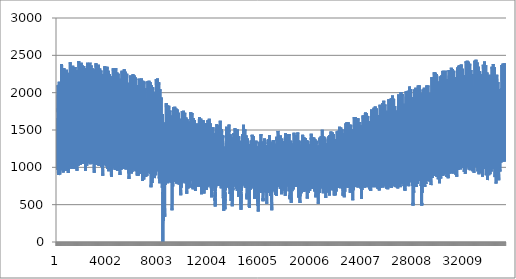
| Category | Series 0 |
|---|---|
| 0 | 1554 |
| 1 | 1593 |
| 2 | 1569 |
| 3 | 1538 |
| 4 | 1501 |
| 5 | 1464 |
| 6 | 1432 |
| 7 | 1389 |
| 8 | 1343 |
| 9 | 1313 |
| 10 | 1277 |
| 11 | 1236 |
| 12 | 1193 |
| 13 | 1161 |
| 14 | 1139 |
| 15 | 1112 |
| 16 | 1097 |
| 17 | 1086 |
| 18 | 1069 |
| 19 | 1056 |
| 20 | 1046 |
| 21 | 1014 |
| 22 | 1013 |
| 23 | 970 |
| 24 | 993 |
| 25 | 998 |
| 26 | 1007 |
| 27 | 1015 |
| 28 | 1045 |
| 29 | 1055 |
| 30 | 1077 |
| 31 | 1094 |
| 32 | 1115 |
| 33 | 1105 |
| 34 | 1113 |
| 35 | 1154 |
| 36 | 1174 |
| 37 | 1217 |
| 38 | 1255 |
| 39 | 1284 |
| 40 | 1311 |
| 41 | 1350 |
| 42 | 1391 |
| 43 | 1439 |
| 44 | 1500 |
| 45 | 1583 |
| 46 | 1633 |
| 47 | 1656 |
| 48 | 1660 |
| 49 | 1593 |
| 50 | 1501 |
| 51 | 1343 |
| 52 | 1271 |
| 53 | 1261 |
| 54 | 1353 |
| 55 | 1409 |
| 56 | 1440 |
| 57 | 1434 |
| 58 | 1399 |
| 59 | 1399 |
| 60 | 1402 |
| 61 | 1410 |
| 62 | 1486 |
| 63 | 1523 |
| 64 | 1577 |
| 65 | 1654 |
| 66 | 1715 |
| 67 | 1828 |
| 68 | 1957 |
| 69 | 2010 |
| 70 | 2057 |
| 71 | 2098 |
| 72 | 2079 |
| 73 | 2075 |
| 74 | 2071 |
| 75 | 2047 |
| 76 | 2048 |
| 77 | 2034 |
| 78 | 2006 |
| 79 | 1972 |
| 80 | 1940 |
| 81 | 1876 |
| 82 | 1794 |
| 83 | 1745 |
| 84 | 1750 |
| 85 | 1739 |
| 86 | 1791 |
| 87 | 1795 |
| 88 | 1729 |
| 89 | 1660 |
| 90 | 1592 |
| 91 | 1515 |
| 92 | 1434 |
| 93 | 1372 |
| 94 | 1283 |
| 95 | 1219 |
| 96 | 1206 |
| 97 | 1208 |
| 98 | 1155 |
| 99 | 1117 |
| 100 | 1081 |
| 101 | 1044 |
| 102 | 1017 |
| 103 | 992 |
| 104 | 969 |
| 105 | 948 |
| 106 | 933 |
| 107 | 922 |
| 108 | 910 |
| 109 | 896 |
| 110 | 894 |
| 111 | 899 |
| 112 | 913 |
| 113 | 915 |
| 114 | 923 |
| 115 | 933 |
| 116 | 946 |
| 117 | 945 |
| 118 | 961 |
| 119 | 946 |
| 120 | 1003 |
| 121 | 1028 |
| 122 | 1058 |
| 123 | 1098 |
| 124 | 1146 |
| 125 | 1201 |
| 126 | 1261 |
| 127 | 1313 |
| 128 | 1360 |
| 129 | 1370 |
| 130 | 1426 |
| 131 | 1469 |
| 132 | 1501 |
| 133 | 1541 |
| 134 | 1577 |
| 135 | 1601 |
| 136 | 1612 |
| 137 | 1650 |
| 138 | 1670 |
| 139 | 1691 |
| 140 | 1720 |
| 141 | 1763 |
| 142 | 1813 |
| 143 | 1829 |
| 144 | 1787 |
| 145 | 1737 |
| 146 | 1708 |
| 147 | 1689 |
| 148 | 1669 |
| 149 | 1605 |
| 150 | 1656 |
| 151 | 1648 |
| 152 | 1659 |
| 153 | 1651 |
| 154 | 1648 |
| 155 | 1652 |
| 156 | 1652 |
| 157 | 1633 |
| 158 | 1633 |
| 159 | 1655 |
| 160 | 1696 |
| 161 | 1750 |
| 162 | 1795 |
| 163 | 1907 |
| 164 | 2030 |
| 165 | 2088 |
| 166 | 2120 |
| 167 | 2147 |
| 168 | 2155 |
| 169 | 2140 |
| 170 | 2124 |
| 171 | 2106 |
| 172 | 2069 |
| 173 | 2034 |
| 174 | 1998 |
| 175 | 1949 |
| 176 | 1898 |
| 177 | 1846 |
| 178 | 1776 |
| 179 | 1715 |
| 180 | 1696 |
| 181 | 1675 |
| 182 | 1713 |
| 183 | 1715 |
| 184 | 1656 |
| 185 | 1610 |
| 186 | 1554 |
| 187 | 1494 |
| 188 | 1437 |
| 189 | 1380 |
| 190 | 1308 |
| 191 | 1246 |
| 192 | 1346 |
| 193 | 1355 |
| 194 | 1308 |
| 195 | 1266 |
| 196 | 1228 |
| 197 | 1186 |
| 198 | 1148 |
| 199 | 1113 |
| 200 | 1092 |
| 201 | 1074 |
| 202 | 1058 |
| 203 | 1043 |
| 204 | 1032 |
| 205 | 1015 |
| 206 | 1005 |
| 207 | 996 |
| 208 | 1002 |
| 209 | 987 |
| 210 | 982 |
| 211 | 981 |
| 212 | 975 |
| 213 | 958 |
| 214 | 946 |
| 215 | 905 |
| 216 | 941 |
| 217 | 945 |
| 218 | 957 |
| 219 | 981 |
| 220 | 1025 |
| 221 | 1063 |
| 222 | 1118 |
| 223 | 1172 |
| 224 | 1201 |
| 225 | 1231 |
| 226 | 1283 |
| 227 | 1343 |
| 228 | 1373 |
| 229 | 1395 |
| 230 | 1420 |
| 231 | 1470 |
| 232 | 1514 |
| 233 | 1546 |
| 234 | 1560 |
| 235 | 1544 |
| 236 | 1589 |
| 237 | 1656 |
| 238 | 1722 |
| 239 | 1737 |
| 240 | 1680 |
| 241 | 1578 |
| 242 | 1558 |
| 243 | 1493 |
| 244 | 1397 |
| 245 | 1388 |
| 246 | 1459 |
| 247 | 1465 |
| 248 | 1441 |
| 249 | 1452 |
| 250 | 1449 |
| 251 | 1425 |
| 252 | 1396 |
| 253 | 1398 |
| 254 | 1440 |
| 255 | 1494 |
| 256 | 1539 |
| 257 | 1600 |
| 258 | 1680 |
| 259 | 1798 |
| 260 | 1945 |
| 261 | 2019 |
| 262 | 2076 |
| 263 | 2113 |
| 264 | 2129 |
| 265 | 2132 |
| 266 | 2124 |
| 267 | 2116 |
| 268 | 2091 |
| 269 | 2043 |
| 270 | 2016 |
| 271 | 1970 |
| 272 | 1933 |
| 273 | 1874 |
| 274 | 1803 |
| 275 | 1745 |
| 276 | 1762 |
| 277 | 1732 |
| 278 | 1768 |
| 279 | 1777 |
| 280 | 1712 |
| 281 | 1641 |
| 282 | 1584 |
| 283 | 1503 |
| 284 | 1413 |
| 285 | 1346 |
| 286 | 1280 |
| 287 | 1215 |
| 288 | 1256 |
| 289 | 1265 |
| 290 | 1226 |
| 291 | 1192 |
| 292 | 1152 |
| 293 | 1112 |
| 294 | 1086 |
| 295 | 1059 |
| 296 | 1034 |
| 297 | 1016 |
| 298 | 998 |
| 299 | 990 |
| 300 | 977 |
| 301 | 969 |
| 302 | 972 |
| 303 | 974 |
| 304 | 1005 |
| 305 | 1010 |
| 306 | 1025 |
| 307 | 1052 |
| 308 | 1098 |
| 309 | 1119 |
| 310 | 1139 |
| 311 | 1173 |
| 312 | 1292 |
| 313 | 1355 |
| 314 | 1422 |
| 315 | 1490 |
| 316 | 1584 |
| 317 | 1666 |
| 318 | 1726 |
| 319 | 1804 |
| 320 | 1832 |
| 321 | 1828 |
| 322 | 1854 |
| 323 | 1856 |
| 324 | 1850 |
| 325 | 1861 |
| 326 | 1908 |
| 327 | 1931 |
| 328 | 1951 |
| 329 | 1952 |
| 330 | 1962 |
| 331 | 1976 |
| 332 | 2011 |
| 333 | 2050 |
| 334 | 2088 |
| 335 | 2088 |
| 336 | 2052 |
| 337 | 2046 |
| 338 | 2010 |
| 339 | 1995 |
| 340 | 1990 |
| 341 | 2002 |
| 342 | 2034 |
| 343 | 1995 |
| 344 | 1982 |
| 345 | 1993 |
| 346 | 1992 |
| 347 | 1976 |
| 348 | 1983 |
| 349 | 1993 |
| 350 | 1989 |
| 351 | 1986 |
| 352 | 2018 |
| 353 | 2061 |
| 354 | 2099 |
| 355 | 2200 |
| 356 | 2285 |
| 357 | 2332 |
| 358 | 2359 |
| 359 | 2385 |
| 360 | 2383 |
| 361 | 2364 |
| 362 | 2351 |
| 363 | 2336 |
| 364 | 2285 |
| 365 | 2240 |
| 366 | 2202 |
| 367 | 2162 |
| 368 | 2092 |
| 369 | 2018 |
| 370 | 1950 |
| 371 | 1899 |
| 372 | 1889 |
| 373 | 1852 |
| 374 | 1873 |
| 375 | 1865 |
| 376 | 1776 |
| 377 | 1692 |
| 378 | 1616 |
| 379 | 1521 |
| 380 | 1425 |
| 381 | 1349 |
| 382 | 1274 |
| 383 | 1214 |
| 384 | 1248 |
| 385 | 1248 |
| 386 | 1194 |
| 387 | 1159 |
| 388 | 1120 |
| 389 | 1090 |
| 390 | 1056 |
| 391 | 1038 |
| 392 | 1024 |
| 393 | 1015 |
| 394 | 1006 |
| 395 | 990 |
| 396 | 984 |
| 397 | 974 |
| 398 | 964 |
| 399 | 960 |
| 400 | 985 |
| 401 | 984 |
| 402 | 1007 |
| 403 | 1021 |
| 404 | 1058 |
| 405 | 1077 |
| 406 | 1109 |
| 407 | 1136 |
| 408 | 1253 |
| 409 | 1326 |
| 410 | 1394 |
| 411 | 1476 |
| 412 | 1564 |
| 413 | 1638 |
| 414 | 1696 |
| 415 | 1764 |
| 416 | 1785 |
| 417 | 1768 |
| 418 | 1757 |
| 419 | 1751 |
| 420 | 1734 |
| 421 | 1744 |
| 422 | 1738 |
| 423 | 1716 |
| 424 | 1721 |
| 425 | 1695 |
| 426 | 1602 |
| 427 | 1555 |
| 428 | 1536 |
| 429 | 1537 |
| 430 | 1544 |
| 431 | 1535 |
| 432 | 1526 |
| 433 | 1494 |
| 434 | 1467 |
| 435 | 1537 |
| 436 | 1605 |
| 437 | 1644 |
| 438 | 1681 |
| 439 | 1646 |
| 440 | 1690 |
| 441 | 1724 |
| 442 | 1733 |
| 443 | 1724 |
| 444 | 1726 |
| 445 | 1734 |
| 446 | 1763 |
| 447 | 1799 |
| 448 | 1822 |
| 449 | 1868 |
| 450 | 1918 |
| 451 | 1982 |
| 452 | 2129 |
| 453 | 2224 |
| 454 | 2278 |
| 455 | 2320 |
| 456 | 2319 |
| 457 | 2317 |
| 458 | 2297 |
| 459 | 2278 |
| 460 | 2235 |
| 461 | 2187 |
| 462 | 2143 |
| 463 | 2110 |
| 464 | 2041 |
| 465 | 1976 |
| 466 | 1910 |
| 467 | 1857 |
| 468 | 1844 |
| 469 | 1794 |
| 470 | 1812 |
| 471 | 1794 |
| 472 | 1692 |
| 473 | 1618 |
| 474 | 1566 |
| 475 | 1475 |
| 476 | 1368 |
| 477 | 1290 |
| 478 | 1220 |
| 479 | 1153 |
| 480 | 1177 |
| 481 | 1193 |
| 482 | 1159 |
| 483 | 1121 |
| 484 | 1084 |
| 485 | 1050 |
| 486 | 1015 |
| 487 | 991 |
| 488 | 973 |
| 489 | 949 |
| 490 | 938 |
| 491 | 930 |
| 492 | 927 |
| 493 | 929 |
| 494 | 938 |
| 495 | 935 |
| 496 | 965 |
| 497 | 963 |
| 498 | 981 |
| 499 | 1009 |
| 500 | 1048 |
| 501 | 1051 |
| 502 | 1084 |
| 503 | 1117 |
| 504 | 1232 |
| 505 | 1299 |
| 506 | 1356 |
| 507 | 1426 |
| 508 | 1523 |
| 509 | 1579 |
| 510 | 1634 |
| 511 | 1700 |
| 512 | 1737 |
| 513 | 1702 |
| 514 | 1707 |
| 515 | 1707 |
| 516 | 1677 |
| 517 | 1660 |
| 518 | 1654 |
| 519 | 1636 |
| 520 | 1588 |
| 521 | 1566 |
| 522 | 1496 |
| 523 | 1457 |
| 524 | 1459 |
| 525 | 1444 |
| 526 | 1465 |
| 527 | 1513 |
| 528 | 1585 |
| 529 | 1564 |
| 530 | 1508 |
| 531 | 1463 |
| 532 | 1508 |
| 533 | 1549 |
| 534 | 1607 |
| 535 | 1550 |
| 536 | 1544 |
| 537 | 1590 |
| 538 | 1617 |
| 539 | 1658 |
| 540 | 1696 |
| 541 | 1688 |
| 542 | 1743 |
| 543 | 1769 |
| 544 | 1798 |
| 545 | 1845 |
| 546 | 1894 |
| 547 | 1968 |
| 548 | 2124 |
| 549 | 2225 |
| 550 | 2288 |
| 551 | 2326 |
| 552 | 2317 |
| 553 | 2291 |
| 554 | 2276 |
| 555 | 2270 |
| 556 | 2231 |
| 557 | 2181 |
| 558 | 2156 |
| 559 | 2123 |
| 560 | 2064 |
| 561 | 1976 |
| 562 | 1898 |
| 563 | 1854 |
| 564 | 1855 |
| 565 | 1819 |
| 566 | 1836 |
| 567 | 1819 |
| 568 | 1737 |
| 569 | 1663 |
| 570 | 1590 |
| 571 | 1508 |
| 572 | 1412 |
| 573 | 1330 |
| 574 | 1259 |
| 575 | 1196 |
| 576 | 1237 |
| 577 | 1247 |
| 578 | 1204 |
| 579 | 1164 |
| 580 | 1133 |
| 581 | 1104 |
| 582 | 1070 |
| 583 | 1035 |
| 584 | 1013 |
| 585 | 998 |
| 586 | 987 |
| 587 | 980 |
| 588 | 975 |
| 589 | 964 |
| 590 | 965 |
| 591 | 964 |
| 592 | 992 |
| 593 | 990 |
| 594 | 1003 |
| 595 | 1027 |
| 596 | 1073 |
| 597 | 1078 |
| 598 | 1110 |
| 599 | 1146 |
| 600 | 1265 |
| 601 | 1328 |
| 602 | 1397 |
| 603 | 1469 |
| 604 | 1556 |
| 605 | 1635 |
| 606 | 1699 |
| 607 | 1744 |
| 608 | 1782 |
| 609 | 1760 |
| 610 | 1755 |
| 611 | 1765 |
| 612 | 1743 |
| 613 | 1725 |
| 614 | 1725 |
| 615 | 1735 |
| 616 | 1771 |
| 617 | 1768 |
| 618 | 1761 |
| 619 | 1744 |
| 620 | 1762 |
| 621 | 1792 |
| 622 | 1795 |
| 623 | 1797 |
| 624 | 1790 |
| 625 | 1700 |
| 626 | 1732 |
| 627 | 1783 |
| 628 | 1799 |
| 629 | 1837 |
| 630 | 1870 |
| 631 | 1849 |
| 632 | 1840 |
| 633 | 1780 |
| 634 | 1793 |
| 635 | 1829 |
| 636 | 1825 |
| 637 | 1805 |
| 638 | 1812 |
| 639 | 1821 |
| 640 | 1857 |
| 641 | 1919 |
| 642 | 1985 |
| 643 | 2046 |
| 644 | 2118 |
| 645 | 2170 |
| 646 | 2220 |
| 647 | 2257 |
| 648 | 2259 |
| 649 | 2241 |
| 650 | 2237 |
| 651 | 2221 |
| 652 | 2169 |
| 653 | 2116 |
| 654 | 2080 |
| 655 | 2054 |
| 656 | 1993 |
| 657 | 1919 |
| 658 | 1858 |
| 659 | 1799 |
| 660 | 1786 |
| 661 | 1746 |
| 662 | 1771 |
| 663 | 1764 |
| 664 | 1659 |
| 665 | 1581 |
| 666 | 1507 |
| 667 | 1426 |
| 668 | 1350 |
| 669 | 1285 |
| 670 | 1221 |
| 671 | 1163 |
| 672 | 1233 |
| 673 | 1252 |
| 674 | 1200 |
| 675 | 1155 |
| 676 | 1113 |
| 677 | 1078 |
| 678 | 1045 |
| 679 | 1013 |
| 680 | 999 |
| 681 | 984 |
| 682 | 973 |
| 683 | 968 |
| 684 | 960 |
| 685 | 954 |
| 686 | 957 |
| 687 | 963 |
| 688 | 981 |
| 689 | 981 |
| 690 | 995 |
| 691 | 1015 |
| 692 | 1060 |
| 693 | 1072 |
| 694 | 1098 |
| 695 | 1115 |
| 696 | 1216 |
| 697 | 1277 |
| 698 | 1343 |
| 699 | 1412 |
| 700 | 1495 |
| 701 | 1568 |
| 702 | 1642 |
| 703 | 1713 |
| 704 | 1731 |
| 705 | 1745 |
| 706 | 1768 |
| 707 | 1759 |
| 708 | 1733 |
| 709 | 1697 |
| 710 | 1715 |
| 711 | 1737 |
| 712 | 1750 |
| 713 | 1686 |
| 714 | 1659 |
| 715 | 1697 |
| 716 | 1742 |
| 717 | 1781 |
| 718 | 1788 |
| 719 | 1783 |
| 720 | 1745 |
| 721 | 1660 |
| 722 | 1639 |
| 723 | 1588 |
| 724 | 1548 |
| 725 | 1577 |
| 726 | 1635 |
| 727 | 1637 |
| 728 | 1639 |
| 729 | 1660 |
| 730 | 1664 |
| 731 | 1650 |
| 732 | 1652 |
| 733 | 1661 |
| 734 | 1689 |
| 735 | 1717 |
| 736 | 1775 |
| 737 | 1830 |
| 738 | 1880 |
| 739 | 1975 |
| 740 | 2102 |
| 741 | 2204 |
| 742 | 2272 |
| 743 | 2306 |
| 744 | 2291 |
| 745 | 2284 |
| 746 | 2271 |
| 747 | 2244 |
| 748 | 2197 |
| 749 | 2152 |
| 750 | 2116 |
| 751 | 2074 |
| 752 | 2018 |
| 753 | 1947 |
| 754 | 1894 |
| 755 | 1837 |
| 756 | 1833 |
| 757 | 1801 |
| 758 | 1831 |
| 759 | 1823 |
| 760 | 1756 |
| 761 | 1703 |
| 762 | 1643 |
| 763 | 1585 |
| 764 | 1506 |
| 765 | 1436 |
| 766 | 1364 |
| 767 | 1294 |
| 768 | 1326 |
| 769 | 1330 |
| 770 | 1277 |
| 771 | 1241 |
| 772 | 1203 |
| 773 | 1164 |
| 774 | 1134 |
| 775 | 1106 |
| 776 | 1082 |
| 777 | 1059 |
| 778 | 1041 |
| 779 | 1028 |
| 780 | 1017 |
| 781 | 1000 |
| 782 | 998 |
| 783 | 1001 |
| 784 | 1012 |
| 785 | 1011 |
| 786 | 1014 |
| 787 | 1018 |
| 788 | 1028 |
| 789 | 1022 |
| 790 | 1037 |
| 791 | 1017 |
| 792 | 1078 |
| 793 | 1108 |
| 794 | 1142 |
| 795 | 1183 |
| 796 | 1240 |
| 797 | 1299 |
| 798 | 1366 |
| 799 | 1430 |
| 800 | 1477 |
| 801 | 1505 |
| 802 | 1560 |
| 803 | 1599 |
| 804 | 1629 |
| 805 | 1646 |
| 806 | 1683 |
| 807 | 1706 |
| 808 | 1713 |
| 809 | 1709 |
| 810 | 1708 |
| 811 | 1721 |
| 812 | 1780 |
| 813 | 1829 |
| 814 | 1850 |
| 815 | 1849 |
| 816 | 1820 |
| 817 | 1767 |
| 818 | 1759 |
| 819 | 1725 |
| 820 | 1688 |
| 821 | 1649 |
| 822 | 1703 |
| 823 | 1703 |
| 824 | 1718 |
| 825 | 1721 |
| 826 | 1709 |
| 827 | 1723 |
| 828 | 1733 |
| 829 | 1714 |
| 830 | 1711 |
| 831 | 1734 |
| 832 | 1756 |
| 833 | 1815 |
| 834 | 1868 |
| 835 | 1969 |
| 836 | 2091 |
| 837 | 2184 |
| 838 | 2235 |
| 839 | 2265 |
| 840 | 2273 |
| 841 | 2260 |
| 842 | 2245 |
| 843 | 2223 |
| 844 | 2188 |
| 845 | 2147 |
| 846 | 2102 |
| 847 | 2047 |
| 848 | 1991 |
| 849 | 1930 |
| 850 | 1853 |
| 851 | 1787 |
| 852 | 1780 |
| 853 | 1763 |
| 854 | 1799 |
| 855 | 1803 |
| 856 | 1740 |
| 857 | 1688 |
| 858 | 1623 |
| 859 | 1566 |
| 860 | 1502 |
| 861 | 1444 |
| 862 | 1371 |
| 863 | 1313 |
| 864 | 1343 |
| 865 | 1352 |
| 866 | 1301 |
| 867 | 1256 |
| 868 | 1220 |
| 869 | 1182 |
| 870 | 1144 |
| 871 | 1111 |
| 872 | 1090 |
| 873 | 1070 |
| 874 | 1050 |
| 875 | 1037 |
| 876 | 1022 |
| 877 | 1003 |
| 878 | 996 |
| 879 | 992 |
| 880 | 999 |
| 881 | 988 |
| 882 | 986 |
| 883 | 989 |
| 884 | 986 |
| 885 | 968 |
| 886 | 960 |
| 887 | 925 |
| 888 | 958 |
| 889 | 966 |
| 890 | 982 |
| 891 | 1005 |
| 892 | 1049 |
| 893 | 1085 |
| 894 | 1139 |
| 895 | 1195 |
| 896 | 1226 |
| 897 | 1263 |
| 898 | 1316 |
| 899 | 1367 |
| 900 | 1394 |
| 901 | 1408 |
| 902 | 1419 |
| 903 | 1443 |
| 904 | 1468 |
| 905 | 1497 |
| 906 | 1507 |
| 907 | 1506 |
| 908 | 1552 |
| 909 | 1635 |
| 910 | 1705 |
| 911 | 1726 |
| 912 | 1676 |
| 913 | 1597 |
| 914 | 1565 |
| 915 | 1477 |
| 916 | 1376 |
| 917 | 1348 |
| 918 | 1369 |
| 919 | 1350 |
| 920 | 1343 |
| 921 | 1362 |
| 922 | 1344 |
| 923 | 1336 |
| 924 | 1331 |
| 925 | 1357 |
| 926 | 1425 |
| 927 | 1477 |
| 928 | 1532 |
| 929 | 1594 |
| 930 | 1666 |
| 931 | 1767 |
| 932 | 1903 |
| 933 | 2016 |
| 934 | 2099 |
| 935 | 2139 |
| 936 | 2156 |
| 937 | 2159 |
| 938 | 2144 |
| 939 | 2127 |
| 940 | 2100 |
| 941 | 2052 |
| 942 | 2026 |
| 943 | 1981 |
| 944 | 1940 |
| 945 | 1881 |
| 946 | 1813 |
| 947 | 1752 |
| 948 | 1764 |
| 949 | 1737 |
| 950 | 1765 |
| 951 | 1771 |
| 952 | 1700 |
| 953 | 1628 |
| 954 | 1568 |
| 955 | 1493 |
| 956 | 1403 |
| 957 | 1335 |
| 958 | 1266 |
| 959 | 1201 |
| 960 | 1243 |
| 961 | 1255 |
| 962 | 1217 |
| 963 | 1183 |
| 964 | 1148 |
| 965 | 1112 |
| 966 | 1082 |
| 967 | 1056 |
| 968 | 1034 |
| 969 | 1017 |
| 970 | 1000 |
| 971 | 992 |
| 972 | 983 |
| 973 | 977 |
| 974 | 985 |
| 975 | 987 |
| 976 | 1018 |
| 977 | 1026 |
| 978 | 1043 |
| 979 | 1068 |
| 980 | 1114 |
| 981 | 1133 |
| 982 | 1167 |
| 983 | 1211 |
| 984 | 1336 |
| 985 | 1414 |
| 986 | 1489 |
| 987 | 1559 |
| 988 | 1657 |
| 989 | 1729 |
| 990 | 1789 |
| 991 | 1857 |
| 992 | 1885 |
| 993 | 1881 |
| 994 | 1908 |
| 995 | 1910 |
| 996 | 1904 |
| 997 | 1912 |
| 998 | 1942 |
| 999 | 1961 |
| 1000 | 1982 |
| 1001 | 1983 |
| 1002 | 1993 |
| 1003 | 2004 |
| 1004 | 2032 |
| 1005 | 2063 |
| 1006 | 2103 |
| 1007 | 2109 |
| 1008 | 2085 |
| 1009 | 2074 |
| 1010 | 2038 |
| 1011 | 2025 |
| 1012 | 2027 |
| 1013 | 2036 |
| 1014 | 2075 |
| 1015 | 2044 |
| 1016 | 2029 |
| 1017 | 2018 |
| 1018 | 2008 |
| 1019 | 1999 |
| 1020 | 2004 |
| 1021 | 2013 |
| 1022 | 2009 |
| 1023 | 2010 |
| 1024 | 2036 |
| 1025 | 2067 |
| 1026 | 2097 |
| 1027 | 2180 |
| 1028 | 2276 |
| 1029 | 2329 |
| 1030 | 2371 |
| 1031 | 2407 |
| 1032 | 2399 |
| 1033 | 2386 |
| 1034 | 2369 |
| 1035 | 2358 |
| 1036 | 2305 |
| 1037 | 2265 |
| 1038 | 2226 |
| 1039 | 2177 |
| 1040 | 2113 |
| 1041 | 2037 |
| 1042 | 1968 |
| 1043 | 1914 |
| 1044 | 1903 |
| 1045 | 1866 |
| 1046 | 1891 |
| 1047 | 1875 |
| 1048 | 1781 |
| 1049 | 1701 |
| 1050 | 1622 |
| 1051 | 1534 |
| 1052 | 1441 |
| 1053 | 1369 |
| 1054 | 1296 |
| 1055 | 1235 |
| 1056 | 1276 |
| 1057 | 1282 |
| 1058 | 1235 |
| 1059 | 1199 |
| 1060 | 1164 |
| 1061 | 1131 |
| 1062 | 1098 |
| 1063 | 1081 |
| 1064 | 1065 |
| 1065 | 1052 |
| 1066 | 1042 |
| 1067 | 1027 |
| 1068 | 1021 |
| 1069 | 1013 |
| 1070 | 1010 |
| 1071 | 1010 |
| 1072 | 1034 |
| 1073 | 1034 |
| 1074 | 1057 |
| 1075 | 1074 |
| 1076 | 1110 |
| 1077 | 1131 |
| 1078 | 1164 |
| 1079 | 1195 |
| 1080 | 1322 |
| 1081 | 1408 |
| 1082 | 1487 |
| 1083 | 1569 |
| 1084 | 1657 |
| 1085 | 1726 |
| 1086 | 1781 |
| 1087 | 1841 |
| 1088 | 1875 |
| 1089 | 1857 |
| 1090 | 1856 |
| 1091 | 1852 |
| 1092 | 1830 |
| 1093 | 1833 |
| 1094 | 1832 |
| 1095 | 1823 |
| 1096 | 1830 |
| 1097 | 1818 |
| 1098 | 1772 |
| 1099 | 1748 |
| 1100 | 1746 |
| 1101 | 1755 |
| 1102 | 1779 |
| 1103 | 1780 |
| 1104 | 1764 |
| 1105 | 1736 |
| 1106 | 1707 |
| 1107 | 1729 |
| 1108 | 1752 |
| 1109 | 1779 |
| 1110 | 1814 |
| 1111 | 1790 |
| 1112 | 1813 |
| 1113 | 1831 |
| 1114 | 1830 |
| 1115 | 1819 |
| 1116 | 1820 |
| 1117 | 1822 |
| 1118 | 1841 |
| 1119 | 1868 |
| 1120 | 1890 |
| 1121 | 1933 |
| 1122 | 1971 |
| 1123 | 2032 |
| 1124 | 2163 |
| 1125 | 2260 |
| 1126 | 2318 |
| 1127 | 2356 |
| 1128 | 2356 |
| 1129 | 2349 |
| 1130 | 2334 |
| 1131 | 2322 |
| 1132 | 2281 |
| 1133 | 2233 |
| 1134 | 2190 |
| 1135 | 2152 |
| 1136 | 2086 |
| 1137 | 2019 |
| 1138 | 1950 |
| 1139 | 1896 |
| 1140 | 1877 |
| 1141 | 1836 |
| 1142 | 1856 |
| 1143 | 1836 |
| 1144 | 1736 |
| 1145 | 1660 |
| 1146 | 1596 |
| 1147 | 1515 |
| 1148 | 1414 |
| 1149 | 1343 |
| 1150 | 1270 |
| 1151 | 1205 |
| 1152 | 1237 |
| 1153 | 1251 |
| 1154 | 1213 |
| 1155 | 1176 |
| 1156 | 1138 |
| 1157 | 1105 |
| 1158 | 1071 |
| 1159 | 1046 |
| 1160 | 1028 |
| 1161 | 1008 |
| 1162 | 994 |
| 1163 | 985 |
| 1164 | 982 |
| 1165 | 980 |
| 1166 | 983 |
| 1167 | 985 |
| 1168 | 1011 |
| 1169 | 1014 |
| 1170 | 1032 |
| 1171 | 1062 |
| 1172 | 1099 |
| 1173 | 1105 |
| 1174 | 1143 |
| 1175 | 1179 |
| 1176 | 1305 |
| 1177 | 1384 |
| 1178 | 1451 |
| 1179 | 1527 |
| 1180 | 1625 |
| 1181 | 1682 |
| 1182 | 1743 |
| 1183 | 1807 |
| 1184 | 1830 |
| 1185 | 1808 |
| 1186 | 1814 |
| 1187 | 1813 |
| 1188 | 1788 |
| 1189 | 1772 |
| 1190 | 1766 |
| 1191 | 1753 |
| 1192 | 1717 |
| 1193 | 1703 |
| 1194 | 1660 |
| 1195 | 1659 |
| 1196 | 1668 |
| 1197 | 1662 |
| 1198 | 1675 |
| 1199 | 1713 |
| 1200 | 1758 |
| 1201 | 1741 |
| 1202 | 1709 |
| 1203 | 1671 |
| 1204 | 1678 |
| 1205 | 1703 |
| 1206 | 1757 |
| 1207 | 1720 |
| 1208 | 1718 |
| 1209 | 1745 |
| 1210 | 1756 |
| 1211 | 1786 |
| 1212 | 1813 |
| 1213 | 1808 |
| 1214 | 1847 |
| 1215 | 1858 |
| 1216 | 1883 |
| 1217 | 1921 |
| 1218 | 1960 |
| 1219 | 2019 |
| 1220 | 2156 |
| 1221 | 2255 |
| 1222 | 2321 |
| 1223 | 2359 |
| 1224 | 2351 |
| 1225 | 2336 |
| 1226 | 2320 |
| 1227 | 2314 |
| 1228 | 2272 |
| 1229 | 2223 |
| 1230 | 2191 |
| 1231 | 2157 |
| 1232 | 2097 |
| 1233 | 2010 |
| 1234 | 1935 |
| 1235 | 1886 |
| 1236 | 1885 |
| 1237 | 1843 |
| 1238 | 1867 |
| 1239 | 1849 |
| 1240 | 1764 |
| 1241 | 1686 |
| 1242 | 1610 |
| 1243 | 1527 |
| 1244 | 1433 |
| 1245 | 1353 |
| 1246 | 1281 |
| 1247 | 1219 |
| 1248 | 1258 |
| 1249 | 1273 |
| 1250 | 1231 |
| 1251 | 1194 |
| 1252 | 1163 |
| 1253 | 1129 |
| 1254 | 1096 |
| 1255 | 1064 |
| 1256 | 1042 |
| 1257 | 1029 |
| 1258 | 1016 |
| 1259 | 1008 |
| 1260 | 1002 |
| 1261 | 994 |
| 1262 | 995 |
| 1263 | 997 |
| 1264 | 1024 |
| 1265 | 1025 |
| 1266 | 1044 |
| 1267 | 1069 |
| 1268 | 1114 |
| 1269 | 1121 |
| 1270 | 1156 |
| 1271 | 1192 |
| 1272 | 1323 |
| 1273 | 1401 |
| 1274 | 1472 |
| 1275 | 1548 |
| 1276 | 1639 |
| 1277 | 1715 |
| 1278 | 1776 |
| 1279 | 1822 |
| 1280 | 1856 |
| 1281 | 1834 |
| 1282 | 1835 |
| 1283 | 1844 |
| 1284 | 1835 |
| 1285 | 1829 |
| 1286 | 1835 |
| 1287 | 1841 |
| 1288 | 1873 |
| 1289 | 1872 |
| 1290 | 1871 |
| 1291 | 1866 |
| 1292 | 1883 |
| 1293 | 1919 |
| 1294 | 1939 |
| 1295 | 1950 |
| 1296 | 1934 |
| 1297 | 1869 |
| 1298 | 1866 |
| 1299 | 1877 |
| 1300 | 1871 |
| 1301 | 1882 |
| 1302 | 1898 |
| 1303 | 1878 |
| 1304 | 1878 |
| 1305 | 1842 |
| 1306 | 1855 |
| 1307 | 1878 |
| 1308 | 1881 |
| 1309 | 1878 |
| 1310 | 1881 |
| 1311 | 1882 |
| 1312 | 1910 |
| 1313 | 1958 |
| 1314 | 2002 |
| 1315 | 2066 |
| 1316 | 2164 |
| 1317 | 2233 |
| 1318 | 2279 |
| 1319 | 2317 |
| 1320 | 2319 |
| 1321 | 2313 |
| 1322 | 2309 |
| 1323 | 2290 |
| 1324 | 2238 |
| 1325 | 2183 |
| 1326 | 2150 |
| 1327 | 2121 |
| 1328 | 2058 |
| 1329 | 1984 |
| 1330 | 1915 |
| 1331 | 1858 |
| 1332 | 1846 |
| 1333 | 1807 |
| 1334 | 1830 |
| 1335 | 1823 |
| 1336 | 1721 |
| 1337 | 1641 |
| 1338 | 1565 |
| 1339 | 1487 |
| 1340 | 1408 |
| 1341 | 1342 |
| 1342 | 1269 |
| 1343 | 1208 |
| 1344 | 1248 |
| 1345 | 1269 |
| 1346 | 1219 |
| 1347 | 1177 |
| 1348 | 1139 |
| 1349 | 1106 |
| 1350 | 1075 |
| 1351 | 1046 |
| 1352 | 1029 |
| 1353 | 1015 |
| 1354 | 1000 |
| 1355 | 996 |
| 1356 | 989 |
| 1357 | 981 |
| 1358 | 987 |
| 1359 | 995 |
| 1360 | 1016 |
| 1361 | 1019 |
| 1362 | 1037 |
| 1363 | 1060 |
| 1364 | 1105 |
| 1365 | 1124 |
| 1366 | 1158 |
| 1367 | 1186 |
| 1368 | 1303 |
| 1369 | 1379 |
| 1370 | 1457 |
| 1371 | 1535 |
| 1372 | 1627 |
| 1373 | 1697 |
| 1374 | 1770 |
| 1375 | 1841 |
| 1376 | 1860 |
| 1377 | 1866 |
| 1378 | 1876 |
| 1379 | 1865 |
| 1380 | 1832 |
| 1381 | 1820 |
| 1382 | 1842 |
| 1383 | 1853 |
| 1384 | 1856 |
| 1385 | 1783 |
| 1386 | 1741 |
| 1387 | 1760 |
| 1388 | 1789 |
| 1389 | 1828 |
| 1390 | 1847 |
| 1391 | 1838 |
| 1392 | 1795 |
| 1393 | 1711 |
| 1394 | 1680 |
| 1395 | 1625 |
| 1396 | 1583 |
| 1397 | 1607 |
| 1398 | 1660 |
| 1399 | 1670 |
| 1400 | 1685 |
| 1401 | 1711 |
| 1402 | 1721 |
| 1403 | 1716 |
| 1404 | 1732 |
| 1405 | 1745 |
| 1406 | 1765 |
| 1407 | 1793 |
| 1408 | 1843 |
| 1409 | 1884 |
| 1410 | 1926 |
| 1411 | 1993 |
| 1412 | 2112 |
| 1413 | 2225 |
| 1414 | 2299 |
| 1415 | 2342 |
| 1416 | 2339 |
| 1417 | 2337 |
| 1418 | 2323 |
| 1419 | 2299 |
| 1420 | 2250 |
| 1421 | 2196 |
| 1422 | 2161 |
| 1423 | 2126 |
| 1424 | 2063 |
| 1425 | 1991 |
| 1426 | 1934 |
| 1427 | 1881 |
| 1428 | 1877 |
| 1429 | 1862 |
| 1430 | 1889 |
| 1431 | 1878 |
| 1432 | 1811 |
| 1433 | 1761 |
| 1434 | 1701 |
| 1435 | 1644 |
| 1436 | 1568 |
| 1437 | 1503 |
| 1438 | 1434 |
| 1439 | 1370 |
| 1440 | 1411 |
| 1441 | 1420 |
| 1442 | 1369 |
| 1443 | 1331 |
| 1444 | 1288 |
| 1445 | 1249 |
| 1446 | 1217 |
| 1447 | 1187 |
| 1448 | 1166 |
| 1449 | 1143 |
| 1450 | 1121 |
| 1451 | 1105 |
| 1452 | 1094 |
| 1453 | 1077 |
| 1454 | 1075 |
| 1455 | 1072 |
| 1456 | 1081 |
| 1457 | 1073 |
| 1458 | 1071 |
| 1459 | 1070 |
| 1460 | 1076 |
| 1461 | 1064 |
| 1462 | 1076 |
| 1463 | 1052 |
| 1464 | 1116 |
| 1465 | 1152 |
| 1466 | 1190 |
| 1467 | 1231 |
| 1468 | 1295 |
| 1469 | 1356 |
| 1470 | 1423 |
| 1471 | 1493 |
| 1472 | 1540 |
| 1473 | 1587 |
| 1474 | 1639 |
| 1475 | 1684 |
| 1476 | 1716 |
| 1477 | 1722 |
| 1478 | 1761 |
| 1479 | 1784 |
| 1480 | 1797 |
| 1481 | 1792 |
| 1482 | 1787 |
| 1483 | 1804 |
| 1484 | 1859 |
| 1485 | 1896 |
| 1486 | 1915 |
| 1487 | 1902 |
| 1488 | 1875 |
| 1489 | 1836 |
| 1490 | 1836 |
| 1491 | 1805 |
| 1492 | 1759 |
| 1493 | 1722 |
| 1494 | 1775 |
| 1495 | 1797 |
| 1496 | 1808 |
| 1497 | 1798 |
| 1498 | 1783 |
| 1499 | 1786 |
| 1500 | 1784 |
| 1501 | 1758 |
| 1502 | 1751 |
| 1503 | 1774 |
| 1504 | 1783 |
| 1505 | 1825 |
| 1506 | 1871 |
| 1507 | 1954 |
| 1508 | 2071 |
| 1509 | 2187 |
| 1510 | 2269 |
| 1511 | 2305 |
| 1512 | 2309 |
| 1513 | 2297 |
| 1514 | 2279 |
| 1515 | 2251 |
| 1516 | 2222 |
| 1517 | 2175 |
| 1518 | 2124 |
| 1519 | 2063 |
| 1520 | 2008 |
| 1521 | 1946 |
| 1522 | 1870 |
| 1523 | 1799 |
| 1524 | 1796 |
| 1525 | 1777 |
| 1526 | 1820 |
| 1527 | 1825 |
| 1528 | 1765 |
| 1529 | 1705 |
| 1530 | 1643 |
| 1531 | 1594 |
| 1532 | 1519 |
| 1533 | 1462 |
| 1534 | 1392 |
| 1535 | 1342 |
| 1536 | 1384 |
| 1537 | 1390 |
| 1538 | 1333 |
| 1539 | 1283 |
| 1540 | 1246 |
| 1541 | 1204 |
| 1542 | 1165 |
| 1543 | 1131 |
| 1544 | 1111 |
| 1545 | 1087 |
| 1546 | 1064 |
| 1547 | 1051 |
| 1548 | 1034 |
| 1549 | 1017 |
| 1550 | 1012 |
| 1551 | 1008 |
| 1552 | 1015 |
| 1553 | 1008 |
| 1554 | 1006 |
| 1555 | 1010 |
| 1556 | 1010 |
| 1557 | 994 |
| 1558 | 990 |
| 1559 | 954 |
| 1560 | 985 |
| 1561 | 994 |
| 1562 | 1019 |
| 1563 | 1039 |
| 1564 | 1082 |
| 1565 | 1120 |
| 1566 | 1171 |
| 1567 | 1229 |
| 1568 | 1257 |
| 1569 | 1307 |
| 1570 | 1367 |
| 1571 | 1422 |
| 1572 | 1458 |
| 1573 | 1487 |
| 1574 | 1505 |
| 1575 | 1525 |
| 1576 | 1548 |
| 1577 | 1580 |
| 1578 | 1588 |
| 1579 | 1611 |
| 1580 | 1654 |
| 1581 | 1737 |
| 1582 | 1799 |
| 1583 | 1813 |
| 1584 | 1757 |
| 1585 | 1703 |
| 1586 | 1655 |
| 1587 | 1558 |
| 1588 | 1483 |
| 1589 | 1471 |
| 1590 | 1450 |
| 1591 | 1377 |
| 1592 | 1357 |
| 1593 | 1369 |
| 1594 | 1374 |
| 1595 | 1399 |
| 1596 | 1406 |
| 1597 | 1435 |
| 1598 | 1501 |
| 1599 | 1526 |
| 1600 | 1569 |
| 1601 | 1624 |
| 1602 | 1681 |
| 1603 | 1759 |
| 1604 | 1872 |
| 1605 | 2014 |
| 1606 | 2124 |
| 1607 | 2171 |
| 1608 | 2192 |
| 1609 | 2191 |
| 1610 | 2172 |
| 1611 | 2150 |
| 1612 | 2116 |
| 1613 | 2070 |
| 1614 | 2040 |
| 1615 | 1997 |
| 1616 | 1956 |
| 1617 | 1892 |
| 1618 | 1827 |
| 1619 | 1767 |
| 1620 | 1772 |
| 1621 | 1747 |
| 1622 | 1776 |
| 1623 | 1780 |
| 1624 | 1703 |
| 1625 | 1633 |
| 1626 | 1564 |
| 1627 | 1495 |
| 1628 | 1403 |
| 1629 | 1336 |
| 1630 | 1266 |
| 1631 | 1209 |
| 1632 | 1254 |
| 1633 | 1268 |
| 1634 | 1234 |
| 1635 | 1197 |
| 1636 | 1167 |
| 1637 | 1134 |
| 1638 | 1100 |
| 1639 | 1074 |
| 1640 | 1056 |
| 1641 | 1041 |
| 1642 | 1028 |
| 1643 | 1018 |
| 1644 | 1015 |
| 1645 | 1007 |
| 1646 | 1013 |
| 1647 | 1018 |
| 1648 | 1048 |
| 1649 | 1059 |
| 1650 | 1070 |
| 1651 | 1090 |
| 1652 | 1132 |
| 1653 | 1147 |
| 1654 | 1189 |
| 1655 | 1241 |
| 1656 | 1379 |
| 1657 | 1473 |
| 1658 | 1557 |
| 1659 | 1625 |
| 1660 | 1728 |
| 1661 | 1791 |
| 1662 | 1849 |
| 1663 | 1899 |
| 1664 | 1929 |
| 1665 | 1920 |
| 1666 | 1938 |
| 1667 | 1943 |
| 1668 | 1932 |
| 1669 | 1924 |
| 1670 | 1936 |
| 1671 | 1919 |
| 1672 | 1909 |
| 1673 | 1899 |
| 1674 | 1939 |
| 1675 | 1971 |
| 1676 | 1987 |
| 1677 | 1998 |
| 1678 | 2034 |
| 1679 | 2034 |
| 1680 | 2026 |
| 1681 | 2018 |
| 1682 | 1998 |
| 1683 | 1993 |
| 1684 | 1964 |
| 1685 | 1948 |
| 1686 | 1993 |
| 1687 | 1978 |
| 1688 | 1968 |
| 1689 | 1919 |
| 1690 | 1889 |
| 1691 | 1925 |
| 1692 | 1965 |
| 1693 | 1966 |
| 1694 | 1946 |
| 1695 | 1944 |
| 1696 | 1981 |
| 1697 | 2021 |
| 1698 | 2054 |
| 1699 | 2121 |
| 1700 | 2216 |
| 1701 | 2308 |
| 1702 | 2378 |
| 1703 | 2425 |
| 1704 | 2419 |
| 1705 | 2414 |
| 1706 | 2397 |
| 1707 | 2386 |
| 1708 | 2332 |
| 1709 | 2297 |
| 1710 | 2255 |
| 1711 | 2207 |
| 1712 | 2154 |
| 1713 | 2075 |
| 1714 | 2000 |
| 1715 | 1938 |
| 1716 | 1919 |
| 1717 | 1880 |
| 1718 | 1908 |
| 1719 | 1889 |
| 1720 | 1795 |
| 1721 | 1718 |
| 1722 | 1634 |
| 1723 | 1549 |
| 1724 | 1464 |
| 1725 | 1393 |
| 1726 | 1325 |
| 1727 | 1265 |
| 1728 | 1309 |
| 1729 | 1321 |
| 1730 | 1279 |
| 1731 | 1244 |
| 1732 | 1215 |
| 1733 | 1182 |
| 1734 | 1153 |
| 1735 | 1132 |
| 1736 | 1113 |
| 1737 | 1095 |
| 1738 | 1087 |
| 1739 | 1074 |
| 1740 | 1063 |
| 1741 | 1056 |
| 1742 | 1061 |
| 1743 | 1063 |
| 1744 | 1088 |
| 1745 | 1088 |
| 1746 | 1111 |
| 1747 | 1136 |
| 1748 | 1171 |
| 1749 | 1192 |
| 1750 | 1228 |
| 1751 | 1262 |
| 1752 | 1400 |
| 1753 | 1499 |
| 1754 | 1587 |
| 1755 | 1667 |
| 1756 | 1755 |
| 1757 | 1816 |
| 1758 | 1867 |
| 1759 | 1908 |
| 1760 | 1944 |
| 1761 | 1937 |
| 1762 | 1938 |
| 1763 | 1928 |
| 1764 | 1886 |
| 1765 | 1866 |
| 1766 | 1853 |
| 1767 | 1839 |
| 1768 | 1822 |
| 1769 | 1810 |
| 1770 | 1835 |
| 1771 | 1841 |
| 1772 | 1852 |
| 1773 | 1883 |
| 1774 | 1906 |
| 1775 | 1890 |
| 1776 | 1868 |
| 1777 | 1856 |
| 1778 | 1802 |
| 1779 | 1772 |
| 1780 | 1733 |
| 1781 | 1736 |
| 1782 | 1772 |
| 1783 | 1767 |
| 1784 | 1768 |
| 1785 | 1763 |
| 1786 | 1756 |
| 1787 | 1757 |
| 1788 | 1770 |
| 1789 | 1771 |
| 1790 | 1792 |
| 1791 | 1820 |
| 1792 | 1854 |
| 1793 | 1895 |
| 1794 | 1938 |
| 1795 | 2004 |
| 1796 | 2121 |
| 1797 | 2231 |
| 1798 | 2332 |
| 1799 | 2384 |
| 1800 | 2387 |
| 1801 | 2381 |
| 1802 | 2377 |
| 1803 | 2368 |
| 1804 | 2326 |
| 1805 | 2284 |
| 1806 | 2242 |
| 1807 | 2198 |
| 1808 | 2134 |
| 1809 | 2064 |
| 1810 | 1996 |
| 1811 | 1938 |
| 1812 | 1915 |
| 1813 | 1884 |
| 1814 | 1908 |
| 1815 | 1882 |
| 1816 | 1784 |
| 1817 | 1704 |
| 1818 | 1626 |
| 1819 | 1549 |
| 1820 | 1458 |
| 1821 | 1393 |
| 1822 | 1321 |
| 1823 | 1259 |
| 1824 | 1300 |
| 1825 | 1306 |
| 1826 | 1267 |
| 1827 | 1230 |
| 1828 | 1195 |
| 1829 | 1163 |
| 1830 | 1135 |
| 1831 | 1107 |
| 1832 | 1088 |
| 1833 | 1074 |
| 1834 | 1064 |
| 1835 | 1050 |
| 1836 | 1044 |
| 1837 | 1036 |
| 1838 | 1039 |
| 1839 | 1045 |
| 1840 | 1068 |
| 1841 | 1073 |
| 1842 | 1088 |
| 1843 | 1115 |
| 1844 | 1150 |
| 1845 | 1163 |
| 1846 | 1208 |
| 1847 | 1241 |
| 1848 | 1378 |
| 1849 | 1469 |
| 1850 | 1543 |
| 1851 | 1625 |
| 1852 | 1719 |
| 1853 | 1780 |
| 1854 | 1843 |
| 1855 | 1906 |
| 1856 | 1915 |
| 1857 | 1915 |
| 1858 | 1921 |
| 1859 | 1918 |
| 1860 | 1901 |
| 1861 | 1893 |
| 1862 | 1893 |
| 1863 | 1889 |
| 1864 | 1865 |
| 1865 | 1867 |
| 1866 | 1857 |
| 1867 | 1890 |
| 1868 | 1909 |
| 1869 | 1905 |
| 1870 | 1908 |
| 1871 | 1932 |
| 1872 | 1946 |
| 1873 | 1934 |
| 1874 | 1918 |
| 1875 | 1893 |
| 1876 | 1861 |
| 1877 | 1867 |
| 1878 | 1923 |
| 1879 | 1913 |
| 1880 | 1906 |
| 1881 | 1910 |
| 1882 | 1903 |
| 1883 | 1908 |
| 1884 | 1919 |
| 1885 | 1921 |
| 1886 | 1933 |
| 1887 | 1935 |
| 1888 | 1959 |
| 1889 | 1987 |
| 1890 | 2015 |
| 1891 | 2070 |
| 1892 | 2179 |
| 1893 | 2280 |
| 1894 | 2356 |
| 1895 | 2400 |
| 1896 | 2393 |
| 1897 | 2391 |
| 1898 | 2375 |
| 1899 | 2359 |
| 1900 | 2316 |
| 1901 | 2273 |
| 1902 | 2237 |
| 1903 | 2202 |
| 1904 | 2137 |
| 1905 | 2054 |
| 1906 | 1978 |
| 1907 | 1926 |
| 1908 | 1925 |
| 1909 | 1879 |
| 1910 | 1908 |
| 1911 | 1893 |
| 1912 | 1806 |
| 1913 | 1724 |
| 1914 | 1649 |
| 1915 | 1570 |
| 1916 | 1475 |
| 1917 | 1399 |
| 1918 | 1327 |
| 1919 | 1262 |
| 1920 | 1305 |
| 1921 | 1328 |
| 1922 | 1285 |
| 1923 | 1251 |
| 1924 | 1218 |
| 1925 | 1182 |
| 1926 | 1149 |
| 1927 | 1122 |
| 1928 | 1099 |
| 1929 | 1083 |
| 1930 | 1068 |
| 1931 | 1058 |
| 1932 | 1056 |
| 1933 | 1047 |
| 1934 | 1053 |
| 1935 | 1057 |
| 1936 | 1084 |
| 1937 | 1090 |
| 1938 | 1108 |
| 1939 | 1131 |
| 1940 | 1173 |
| 1941 | 1182 |
| 1942 | 1222 |
| 1943 | 1257 |
| 1944 | 1398 |
| 1945 | 1483 |
| 1946 | 1560 |
| 1947 | 1642 |
| 1948 | 1735 |
| 1949 | 1806 |
| 1950 | 1863 |
| 1951 | 1893 |
| 1952 | 1923 |
| 1953 | 1906 |
| 1954 | 1901 |
| 1955 | 1894 |
| 1956 | 1877 |
| 1957 | 1874 |
| 1958 | 1873 |
| 1959 | 1855 |
| 1960 | 1864 |
| 1961 | 1849 |
| 1962 | 1842 |
| 1963 | 1831 |
| 1964 | 1822 |
| 1965 | 1844 |
| 1966 | 1856 |
| 1967 | 1859 |
| 1968 | 1826 |
| 1969 | 1799 |
| 1970 | 1766 |
| 1971 | 1746 |
| 1972 | 1731 |
| 1973 | 1755 |
| 1974 | 1809 |
| 1975 | 1797 |
| 1976 | 1792 |
| 1977 | 1787 |
| 1978 | 1793 |
| 1979 | 1789 |
| 1980 | 1792 |
| 1981 | 1817 |
| 1982 | 1836 |
| 1983 | 1843 |
| 1984 | 1877 |
| 1985 | 1924 |
| 1986 | 1960 |
| 1987 | 2024 |
| 1988 | 2141 |
| 1989 | 2228 |
| 1990 | 2311 |
| 1991 | 2365 |
| 1992 | 2370 |
| 1993 | 2375 |
| 1994 | 2370 |
| 1995 | 2353 |
| 1996 | 2307 |
| 1997 | 2252 |
| 1998 | 2217 |
| 1999 | 2194 |
| 2000 | 2131 |
| 2001 | 2056 |
| 2002 | 1986 |
| 2003 | 1927 |
| 2004 | 1912 |
| 2005 | 1874 |
| 2006 | 1893 |
| 2007 | 1889 |
| 2008 | 1794 |
| 2009 | 1713 |
| 2010 | 1634 |
| 2011 | 1554 |
| 2012 | 1472 |
| 2013 | 1402 |
| 2014 | 1324 |
| 2015 | 1265 |
| 2016 | 1303 |
| 2017 | 1325 |
| 2018 | 1275 |
| 2019 | 1236 |
| 2020 | 1203 |
| 2021 | 1173 |
| 2022 | 1143 |
| 2023 | 1113 |
| 2024 | 1096 |
| 2025 | 1081 |
| 2026 | 1063 |
| 2027 | 1059 |
| 2028 | 1053 |
| 2029 | 1048 |
| 2030 | 1052 |
| 2031 | 1057 |
| 2032 | 1075 |
| 2033 | 1079 |
| 2034 | 1098 |
| 2035 | 1120 |
| 2036 | 1164 |
| 2037 | 1180 |
| 2038 | 1218 |
| 2039 | 1246 |
| 2040 | 1375 |
| 2041 | 1464 |
| 2042 | 1554 |
| 2043 | 1639 |
| 2044 | 1732 |
| 2045 | 1797 |
| 2046 | 1864 |
| 2047 | 1911 |
| 2048 | 1938 |
| 2049 | 1953 |
| 2050 | 1954 |
| 2051 | 1941 |
| 2052 | 1917 |
| 2053 | 1904 |
| 2054 | 1923 |
| 2055 | 1929 |
| 2056 | 1925 |
| 2057 | 1877 |
| 2058 | 1836 |
| 2059 | 1857 |
| 2060 | 1844 |
| 2061 | 1827 |
| 2062 | 1801 |
| 2063 | 1743 |
| 2064 | 1697 |
| 2065 | 1671 |
| 2066 | 1598 |
| 2067 | 1546 |
| 2068 | 1525 |
| 2069 | 1537 |
| 2070 | 1576 |
| 2071 | 1564 |
| 2072 | 1580 |
| 2073 | 1595 |
| 2074 | 1597 |
| 2075 | 1603 |
| 2076 | 1633 |
| 2077 | 1667 |
| 2078 | 1703 |
| 2079 | 1742 |
| 2080 | 1803 |
| 2081 | 1854 |
| 2082 | 1897 |
| 2083 | 1970 |
| 2084 | 2083 |
| 2085 | 2195 |
| 2086 | 2286 |
| 2087 | 2357 |
| 2088 | 2370 |
| 2089 | 2370 |
| 2090 | 2362 |
| 2091 | 2334 |
| 2092 | 2286 |
| 2093 | 2231 |
| 2094 | 2192 |
| 2095 | 2155 |
| 2096 | 2100 |
| 2097 | 2025 |
| 2098 | 1960 |
| 2099 | 1906 |
| 2100 | 1909 |
| 2101 | 1886 |
| 2102 | 1917 |
| 2103 | 1912 |
| 2104 | 1843 |
| 2105 | 1788 |
| 2106 | 1727 |
| 2107 | 1664 |
| 2108 | 1585 |
| 2109 | 1523 |
| 2110 | 1459 |
| 2111 | 1397 |
| 2112 | 1437 |
| 2113 | 1442 |
| 2114 | 1397 |
| 2115 | 1355 |
| 2116 | 1313 |
| 2117 | 1278 |
| 2118 | 1244 |
| 2119 | 1213 |
| 2120 | 1184 |
| 2121 | 1156 |
| 2122 | 1133 |
| 2123 | 1117 |
| 2124 | 1106 |
| 2125 | 1092 |
| 2126 | 1088 |
| 2127 | 1083 |
| 2128 | 1093 |
| 2129 | 1083 |
| 2130 | 1084 |
| 2131 | 1085 |
| 2132 | 1091 |
| 2133 | 1076 |
| 2134 | 1086 |
| 2135 | 1061 |
| 2136 | 1129 |
| 2137 | 1166 |
| 2138 | 1206 |
| 2139 | 1245 |
| 2140 | 1311 |
| 2141 | 1369 |
| 2142 | 1449 |
| 2143 | 1505 |
| 2144 | 1546 |
| 2145 | 1598 |
| 2146 | 1646 |
| 2147 | 1698 |
| 2148 | 1750 |
| 2149 | 1747 |
| 2150 | 1776 |
| 2151 | 1807 |
| 2152 | 1823 |
| 2153 | 1767 |
| 2154 | 1726 |
| 2155 | 1740 |
| 2156 | 1764 |
| 2157 | 1763 |
| 2158 | 1792 |
| 2159 | 1810 |
| 2160 | 1836 |
| 2161 | 1830 |
| 2162 | 1837 |
| 2163 | 1800 |
| 2164 | 1767 |
| 2165 | 1786 |
| 2166 | 1823 |
| 2167 | 1810 |
| 2168 | 1795 |
| 2169 | 1791 |
| 2170 | 1797 |
| 2171 | 1793 |
| 2172 | 1810 |
| 2173 | 1808 |
| 2174 | 1812 |
| 2175 | 1817 |
| 2176 | 1816 |
| 2177 | 1849 |
| 2178 | 1888 |
| 2179 | 1964 |
| 2180 | 2060 |
| 2181 | 2186 |
| 2182 | 2284 |
| 2183 | 2331 |
| 2184 | 2343 |
| 2185 | 2327 |
| 2186 | 2303 |
| 2187 | 2272 |
| 2188 | 2242 |
| 2189 | 2201 |
| 2190 | 2146 |
| 2191 | 2088 |
| 2192 | 2025 |
| 2193 | 1955 |
| 2194 | 1891 |
| 2195 | 1826 |
| 2196 | 1820 |
| 2197 | 1797 |
| 2198 | 1834 |
| 2199 | 1831 |
| 2200 | 1771 |
| 2201 | 1707 |
| 2202 | 1647 |
| 2203 | 1606 |
| 2204 | 1531 |
| 2205 | 1469 |
| 2206 | 1406 |
| 2207 | 1355 |
| 2208 | 1396 |
| 2209 | 1404 |
| 2210 | 1348 |
| 2211 | 1294 |
| 2212 | 1250 |
| 2213 | 1206 |
| 2214 | 1162 |
| 2215 | 1127 |
| 2216 | 1105 |
| 2217 | 1077 |
| 2218 | 1053 |
| 2219 | 1040 |
| 2220 | 1024 |
| 2221 | 1009 |
| 2222 | 1004 |
| 2223 | 1004 |
| 2224 | 1010 |
| 2225 | 1003 |
| 2226 | 1000 |
| 2227 | 1002 |
| 2228 | 1004 |
| 2229 | 988 |
| 2230 | 985 |
| 2231 | 953 |
| 2232 | 981 |
| 2233 | 994 |
| 2234 | 1017 |
| 2235 | 1041 |
| 2236 | 1087 |
| 2237 | 1127 |
| 2238 | 1179 |
| 2239 | 1225 |
| 2240 | 1263 |
| 2241 | 1318 |
| 2242 | 1388 |
| 2243 | 1441 |
| 2244 | 1493 |
| 2245 | 1538 |
| 2246 | 1567 |
| 2247 | 1599 |
| 2248 | 1617 |
| 2249 | 1668 |
| 2250 | 1708 |
| 2251 | 1748 |
| 2252 | 1800 |
| 2253 | 1864 |
| 2254 | 1898 |
| 2255 | 1896 |
| 2256 | 1863 |
| 2257 | 1823 |
| 2258 | 1774 |
| 2259 | 1685 |
| 2260 | 1615 |
| 2261 | 1575 |
| 2262 | 1576 |
| 2263 | 1495 |
| 2264 | 1474 |
| 2265 | 1472 |
| 2266 | 1458 |
| 2267 | 1464 |
| 2268 | 1472 |
| 2269 | 1495 |
| 2270 | 1529 |
| 2271 | 1542 |
| 2272 | 1574 |
| 2273 | 1613 |
| 2274 | 1661 |
| 2275 | 1729 |
| 2276 | 1812 |
| 2277 | 1943 |
| 2278 | 2076 |
| 2279 | 2152 |
| 2280 | 2180 |
| 2281 | 2180 |
| 2282 | 2160 |
| 2283 | 2132 |
| 2284 | 2101 |
| 2285 | 2057 |
| 2286 | 2032 |
| 2287 | 1995 |
| 2288 | 1958 |
| 2289 | 1890 |
| 2290 | 1826 |
| 2291 | 1769 |
| 2292 | 1770 |
| 2293 | 1753 |
| 2294 | 1778 |
| 2295 | 1790 |
| 2296 | 1707 |
| 2297 | 1636 |
| 2298 | 1563 |
| 2299 | 1496 |
| 2300 | 1409 |
| 2301 | 1341 |
| 2302 | 1269 |
| 2303 | 1211 |
| 2304 | 1257 |
| 2305 | 1273 |
| 2306 | 1238 |
| 2307 | 1202 |
| 2308 | 1175 |
| 2309 | 1141 |
| 2310 | 1105 |
| 2311 | 1080 |
| 2312 | 1065 |
| 2313 | 1050 |
| 2314 | 1036 |
| 2315 | 1026 |
| 2316 | 1022 |
| 2317 | 1011 |
| 2318 | 1015 |
| 2319 | 1022 |
| 2320 | 1050 |
| 2321 | 1058 |
| 2322 | 1071 |
| 2323 | 1096 |
| 2324 | 1137 |
| 2325 | 1153 |
| 2326 | 1195 |
| 2327 | 1235 |
| 2328 | 1372 |
| 2329 | 1471 |
| 2330 | 1551 |
| 2331 | 1621 |
| 2332 | 1721 |
| 2333 | 1786 |
| 2334 | 1844 |
| 2335 | 1870 |
| 2336 | 1898 |
| 2337 | 1900 |
| 2338 | 1910 |
| 2339 | 1904 |
| 2340 | 1886 |
| 2341 | 1863 |
| 2342 | 1863 |
| 2343 | 1846 |
| 2344 | 1835 |
| 2345 | 1828 |
| 2346 | 1862 |
| 2347 | 1889 |
| 2348 | 1929 |
| 2349 | 1955 |
| 2350 | 2000 |
| 2351 | 2001 |
| 2352 | 1991 |
| 2353 | 1980 |
| 2354 | 1966 |
| 2355 | 1963 |
| 2356 | 1917 |
| 2357 | 1907 |
| 2358 | 1950 |
| 2359 | 1938 |
| 2360 | 1926 |
| 2361 | 1888 |
| 2362 | 1857 |
| 2363 | 1888 |
| 2364 | 1928 |
| 2365 | 1932 |
| 2366 | 1916 |
| 2367 | 1911 |
| 2368 | 1943 |
| 2369 | 1978 |
| 2370 | 2005 |
| 2371 | 2055 |
| 2372 | 2146 |
| 2373 | 2253 |
| 2374 | 2349 |
| 2375 | 2401 |
| 2376 | 2405 |
| 2377 | 2398 |
| 2378 | 2388 |
| 2379 | 2380 |
| 2380 | 2339 |
| 2381 | 2302 |
| 2382 | 2260 |
| 2383 | 2207 |
| 2384 | 2161 |
| 2385 | 2078 |
| 2386 | 1998 |
| 2387 | 1934 |
| 2388 | 1908 |
| 2389 | 1874 |
| 2390 | 1902 |
| 2391 | 1883 |
| 2392 | 1786 |
| 2393 | 1707 |
| 2394 | 1625 |
| 2395 | 1548 |
| 2396 | 1464 |
| 2397 | 1391 |
| 2398 | 1320 |
| 2399 | 1262 |
| 2400 | 1304 |
| 2401 | 1317 |
| 2402 | 1279 |
| 2403 | 1245 |
| 2404 | 1215 |
| 2405 | 1185 |
| 2406 | 1154 |
| 2407 | 1129 |
| 2408 | 1111 |
| 2409 | 1093 |
| 2410 | 1083 |
| 2411 | 1069 |
| 2412 | 1063 |
| 2413 | 1055 |
| 2414 | 1062 |
| 2415 | 1065 |
| 2416 | 1087 |
| 2417 | 1090 |
| 2418 | 1109 |
| 2419 | 1138 |
| 2420 | 1172 |
| 2421 | 1189 |
| 2422 | 1223 |
| 2423 | 1255 |
| 2424 | 1398 |
| 2425 | 1497 |
| 2426 | 1582 |
| 2427 | 1661 |
| 2428 | 1751 |
| 2429 | 1812 |
| 2430 | 1867 |
| 2431 | 1888 |
| 2432 | 1926 |
| 2433 | 1923 |
| 2434 | 1927 |
| 2435 | 1915 |
| 2436 | 1879 |
| 2437 | 1861 |
| 2438 | 1855 |
| 2439 | 1850 |
| 2440 | 1844 |
| 2441 | 1843 |
| 2442 | 1867 |
| 2443 | 1867 |
| 2444 | 1873 |
| 2445 | 1893 |
| 2446 | 1906 |
| 2447 | 1882 |
| 2448 | 1862 |
| 2449 | 1847 |
| 2450 | 1798 |
| 2451 | 1779 |
| 2452 | 1741 |
| 2453 | 1727 |
| 2454 | 1767 |
| 2455 | 1782 |
| 2456 | 1773 |
| 2457 | 1755 |
| 2458 | 1733 |
| 2459 | 1743 |
| 2460 | 1757 |
| 2461 | 1740 |
| 2462 | 1763 |
| 2463 | 1795 |
| 2464 | 1833 |
| 2465 | 1862 |
| 2466 | 1890 |
| 2467 | 1940 |
| 2468 | 2026 |
| 2469 | 2137 |
| 2470 | 2268 |
| 2471 | 2362 |
| 2472 | 2384 |
| 2473 | 2382 |
| 2474 | 2379 |
| 2475 | 2374 |
| 2476 | 2331 |
| 2477 | 2286 |
| 2478 | 2244 |
| 2479 | 2200 |
| 2480 | 2148 |
| 2481 | 2071 |
| 2482 | 1999 |
| 2483 | 1943 |
| 2484 | 1918 |
| 2485 | 1885 |
| 2486 | 1901 |
| 2487 | 1876 |
| 2488 | 1790 |
| 2489 | 1709 |
| 2490 | 1627 |
| 2491 | 1552 |
| 2492 | 1466 |
| 2493 | 1399 |
| 2494 | 1328 |
| 2495 | 1265 |
| 2496 | 1310 |
| 2497 | 1318 |
| 2498 | 1276 |
| 2499 | 1240 |
| 2500 | 1210 |
| 2501 | 1180 |
| 2502 | 1155 |
| 2503 | 1131 |
| 2504 | 1116 |
| 2505 | 1095 |
| 2506 | 1084 |
| 2507 | 1073 |
| 2508 | 1067 |
| 2509 | 1059 |
| 2510 | 1059 |
| 2511 | 1061 |
| 2512 | 1084 |
| 2513 | 1085 |
| 2514 | 1102 |
| 2515 | 1133 |
| 2516 | 1167 |
| 2517 | 1182 |
| 2518 | 1223 |
| 2519 | 1250 |
| 2520 | 1386 |
| 2521 | 1476 |
| 2522 | 1552 |
| 2523 | 1640 |
| 2524 | 1734 |
| 2525 | 1795 |
| 2526 | 1857 |
| 2527 | 1896 |
| 2528 | 1907 |
| 2529 | 1915 |
| 2530 | 1918 |
| 2531 | 1916 |
| 2532 | 1889 |
| 2533 | 1883 |
| 2534 | 1908 |
| 2535 | 1915 |
| 2536 | 1916 |
| 2537 | 1912 |
| 2538 | 1917 |
| 2539 | 1928 |
| 2540 | 1921 |
| 2541 | 1938 |
| 2542 | 1953 |
| 2543 | 1904 |
| 2544 | 1872 |
| 2545 | 1862 |
| 2546 | 1838 |
| 2547 | 1862 |
| 2548 | 1848 |
| 2549 | 1875 |
| 2550 | 1937 |
| 2551 | 1924 |
| 2552 | 1925 |
| 2553 | 1939 |
| 2554 | 1954 |
| 2555 | 1953 |
| 2556 | 1945 |
| 2557 | 1951 |
| 2558 | 1952 |
| 2559 | 1943 |
| 2560 | 1960 |
| 2561 | 1986 |
| 2562 | 2016 |
| 2563 | 2074 |
| 2564 | 2156 |
| 2565 | 2244 |
| 2566 | 2333 |
| 2567 | 2402 |
| 2568 | 2399 |
| 2569 | 2399 |
| 2570 | 2381 |
| 2571 | 2375 |
| 2572 | 2337 |
| 2573 | 2290 |
| 2574 | 2251 |
| 2575 | 2202 |
| 2576 | 2140 |
| 2577 | 2058 |
| 2578 | 1982 |
| 2579 | 1926 |
| 2580 | 1922 |
| 2581 | 1882 |
| 2582 | 1908 |
| 2583 | 1885 |
| 2584 | 1796 |
| 2585 | 1715 |
| 2586 | 1639 |
| 2587 | 1555 |
| 2588 | 1463 |
| 2589 | 1387 |
| 2590 | 1316 |
| 2591 | 1255 |
| 2592 | 1298 |
| 2593 | 1317 |
| 2594 | 1270 |
| 2595 | 1236 |
| 2596 | 1198 |
| 2597 | 1162 |
| 2598 | 1129 |
| 2599 | 1101 |
| 2600 | 1080 |
| 2601 | 1067 |
| 2602 | 1056 |
| 2603 | 1046 |
| 2604 | 1041 |
| 2605 | 1036 |
| 2606 | 1042 |
| 2607 | 1052 |
| 2608 | 1081 |
| 2609 | 1085 |
| 2610 | 1105 |
| 2611 | 1128 |
| 2612 | 1167 |
| 2613 | 1173 |
| 2614 | 1211 |
| 2615 | 1244 |
| 2616 | 1384 |
| 2617 | 1470 |
| 2618 | 1547 |
| 2619 | 1632 |
| 2620 | 1722 |
| 2621 | 1788 |
| 2622 | 1846 |
| 2623 | 1856 |
| 2624 | 1885 |
| 2625 | 1882 |
| 2626 | 1862 |
| 2627 | 1852 |
| 2628 | 1832 |
| 2629 | 1832 |
| 2630 | 1835 |
| 2631 | 1806 |
| 2632 | 1773 |
| 2633 | 1773 |
| 2634 | 1783 |
| 2635 | 1775 |
| 2636 | 1757 |
| 2637 | 1785 |
| 2638 | 1804 |
| 2639 | 1802 |
| 2640 | 1767 |
| 2641 | 1677 |
| 2642 | 1654 |
| 2643 | 1676 |
| 2644 | 1666 |
| 2645 | 1661 |
| 2646 | 1698 |
| 2647 | 1691 |
| 2648 | 1686 |
| 2649 | 1678 |
| 2650 | 1680 |
| 2651 | 1703 |
| 2652 | 1730 |
| 2653 | 1748 |
| 2654 | 1718 |
| 2655 | 1718 |
| 2656 | 1780 |
| 2657 | 1854 |
| 2658 | 1887 |
| 2659 | 1940 |
| 2660 | 2039 |
| 2661 | 2137 |
| 2662 | 2245 |
| 2663 | 2338 |
| 2664 | 2351 |
| 2665 | 2363 |
| 2666 | 2361 |
| 2667 | 2343 |
| 2668 | 2305 |
| 2669 | 2252 |
| 2670 | 2217 |
| 2671 | 2198 |
| 2672 | 2132 |
| 2673 | 2048 |
| 2674 | 1971 |
| 2675 | 1921 |
| 2676 | 1912 |
| 2677 | 1868 |
| 2678 | 1893 |
| 2679 | 1893 |
| 2680 | 1798 |
| 2681 | 1717 |
| 2682 | 1638 |
| 2683 | 1560 |
| 2684 | 1472 |
| 2685 | 1397 |
| 2686 | 1324 |
| 2687 | 1263 |
| 2688 | 1294 |
| 2689 | 1315 |
| 2690 | 1272 |
| 2691 | 1232 |
| 2692 | 1204 |
| 2693 | 1167 |
| 2694 | 1138 |
| 2695 | 1121 |
| 2696 | 1101 |
| 2697 | 1082 |
| 2698 | 1063 |
| 2699 | 1056 |
| 2700 | 1051 |
| 2701 | 1049 |
| 2702 | 1049 |
| 2703 | 1052 |
| 2704 | 1073 |
| 2705 | 1077 |
| 2706 | 1103 |
| 2707 | 1127 |
| 2708 | 1163 |
| 2709 | 1175 |
| 2710 | 1214 |
| 2711 | 1243 |
| 2712 | 1369 |
| 2713 | 1461 |
| 2714 | 1550 |
| 2715 | 1631 |
| 2716 | 1730 |
| 2717 | 1798 |
| 2718 | 1861 |
| 2719 | 1883 |
| 2720 | 1919 |
| 2721 | 1926 |
| 2722 | 1905 |
| 2723 | 1898 |
| 2724 | 1879 |
| 2725 | 1851 |
| 2726 | 1815 |
| 2727 | 1831 |
| 2728 | 1866 |
| 2729 | 1882 |
| 2730 | 1881 |
| 2731 | 1873 |
| 2732 | 1869 |
| 2733 | 1869 |
| 2734 | 1868 |
| 2735 | 1860 |
| 2736 | 1828 |
| 2737 | 1795 |
| 2738 | 1755 |
| 2739 | 1727 |
| 2740 | 1719 |
| 2741 | 1716 |
| 2742 | 1720 |
| 2743 | 1708 |
| 2744 | 1717 |
| 2745 | 1716 |
| 2746 | 1728 |
| 2747 | 1723 |
| 2748 | 1719 |
| 2749 | 1733 |
| 2750 | 1765 |
| 2751 | 1788 |
| 2752 | 1823 |
| 2753 | 1863 |
| 2754 | 1900 |
| 2755 | 1955 |
| 2756 | 2043 |
| 2757 | 2124 |
| 2758 | 2202 |
| 2759 | 2296 |
| 2760 | 2326 |
| 2761 | 2333 |
| 2762 | 2330 |
| 2763 | 2311 |
| 2764 | 2264 |
| 2765 | 2211 |
| 2766 | 2173 |
| 2767 | 2132 |
| 2768 | 2084 |
| 2769 | 2010 |
| 2770 | 1939 |
| 2771 | 1888 |
| 2772 | 1889 |
| 2773 | 1867 |
| 2774 | 1902 |
| 2775 | 1897 |
| 2776 | 1833 |
| 2777 | 1772 |
| 2778 | 1711 |
| 2779 | 1645 |
| 2780 | 1564 |
| 2781 | 1503 |
| 2782 | 1434 |
| 2783 | 1376 |
| 2784 | 1409 |
| 2785 | 1414 |
| 2786 | 1370 |
| 2787 | 1324 |
| 2788 | 1285 |
| 2789 | 1251 |
| 2790 | 1217 |
| 2791 | 1190 |
| 2792 | 1164 |
| 2793 | 1139 |
| 2794 | 1122 |
| 2795 | 1105 |
| 2796 | 1096 |
| 2797 | 1089 |
| 2798 | 1083 |
| 2799 | 1078 |
| 2800 | 1088 |
| 2801 | 1074 |
| 2802 | 1073 |
| 2803 | 1073 |
| 2804 | 1080 |
| 2805 | 1065 |
| 2806 | 1071 |
| 2807 | 1049 |
| 2808 | 1117 |
| 2809 | 1157 |
| 2810 | 1197 |
| 2811 | 1237 |
| 2812 | 1303 |
| 2813 | 1367 |
| 2814 | 1429 |
| 2815 | 1474 |
| 2816 | 1526 |
| 2817 | 1576 |
| 2818 | 1630 |
| 2819 | 1680 |
| 2820 | 1732 |
| 2821 | 1746 |
| 2822 | 1780 |
| 2823 | 1818 |
| 2824 | 1851 |
| 2825 | 1842 |
| 2826 | 1827 |
| 2827 | 1846 |
| 2828 | 1829 |
| 2829 | 1806 |
| 2830 | 1848 |
| 2831 | 1869 |
| 2832 | 1870 |
| 2833 | 1861 |
| 2834 | 1848 |
| 2835 | 1832 |
| 2836 | 1810 |
| 2837 | 1809 |
| 2838 | 1832 |
| 2839 | 1831 |
| 2840 | 1824 |
| 2841 | 1806 |
| 2842 | 1825 |
| 2843 | 1813 |
| 2844 | 1807 |
| 2845 | 1804 |
| 2846 | 1808 |
| 2847 | 1817 |
| 2848 | 1834 |
| 2849 | 1859 |
| 2850 | 1885 |
| 2851 | 1950 |
| 2852 | 2029 |
| 2853 | 2133 |
| 2854 | 2248 |
| 2855 | 2311 |
| 2856 | 2323 |
| 2857 | 2312 |
| 2858 | 2289 |
| 2859 | 2254 |
| 2860 | 2215 |
| 2861 | 2168 |
| 2862 | 2116 |
| 2863 | 2065 |
| 2864 | 2007 |
| 2865 | 1938 |
| 2866 | 1871 |
| 2867 | 1813 |
| 2868 | 1804 |
| 2869 | 1768 |
| 2870 | 1808 |
| 2871 | 1799 |
| 2872 | 1739 |
| 2873 | 1680 |
| 2874 | 1623 |
| 2875 | 1580 |
| 2876 | 1505 |
| 2877 | 1439 |
| 2878 | 1369 |
| 2879 | 1319 |
| 2880 | 1365 |
| 2881 | 1374 |
| 2882 | 1320 |
| 2883 | 1270 |
| 2884 | 1226 |
| 2885 | 1175 |
| 2886 | 1134 |
| 2887 | 1099 |
| 2888 | 1077 |
| 2889 | 1047 |
| 2890 | 1025 |
| 2891 | 1010 |
| 2892 | 994 |
| 2893 | 983 |
| 2894 | 982 |
| 2895 | 980 |
| 2896 | 983 |
| 2897 | 975 |
| 2898 | 970 |
| 2899 | 973 |
| 2900 | 975 |
| 2901 | 958 |
| 2902 | 958 |
| 2903 | 927 |
| 2904 | 956 |
| 2905 | 969 |
| 2906 | 993 |
| 2907 | 1016 |
| 2908 | 1065 |
| 2909 | 1108 |
| 2910 | 1143 |
| 2911 | 1190 |
| 2912 | 1236 |
| 2913 | 1296 |
| 2914 | 1363 |
| 2915 | 1417 |
| 2916 | 1472 |
| 2917 | 1532 |
| 2918 | 1586 |
| 2919 | 1629 |
| 2920 | 1644 |
| 2921 | 1707 |
| 2922 | 1769 |
| 2923 | 1832 |
| 2924 | 1873 |
| 2925 | 1902 |
| 2926 | 1898 |
| 2927 | 1920 |
| 2928 | 1878 |
| 2929 | 1771 |
| 2930 | 1678 |
| 2931 | 1648 |
| 2932 | 1633 |
| 2933 | 1582 |
| 2934 | 1588 |
| 2935 | 1530 |
| 2936 | 1421 |
| 2937 | 1405 |
| 2938 | 1480 |
| 2939 | 1526 |
| 2940 | 1478 |
| 2941 | 1503 |
| 2942 | 1522 |
| 2943 | 1527 |
| 2944 | 1547 |
| 2945 | 1575 |
| 2946 | 1605 |
| 2947 | 1671 |
| 2948 | 1755 |
| 2949 | 1862 |
| 2950 | 1986 |
| 2951 | 2089 |
| 2952 | 2148 |
| 2953 | 2164 |
| 2954 | 2155 |
| 2955 | 2132 |
| 2956 | 2092 |
| 2957 | 2058 |
| 2958 | 2027 |
| 2959 | 1996 |
| 2960 | 1952 |
| 2961 | 1883 |
| 2962 | 1817 |
| 2963 | 1761 |
| 2964 | 1752 |
| 2965 | 1738 |
| 2966 | 1768 |
| 2967 | 1779 |
| 2968 | 1705 |
| 2969 | 1632 |
| 2970 | 1556 |
| 2971 | 1490 |
| 2972 | 1405 |
| 2973 | 1334 |
| 2974 | 1267 |
| 2975 | 1214 |
| 2976 | 1263 |
| 2977 | 1281 |
| 2978 | 1243 |
| 2979 | 1211 |
| 2980 | 1185 |
| 2981 | 1155 |
| 2982 | 1124 |
| 2983 | 1099 |
| 2984 | 1082 |
| 2985 | 1068 |
| 2986 | 1054 |
| 2987 | 1044 |
| 2988 | 1042 |
| 2989 | 1030 |
| 2990 | 1031 |
| 2991 | 1037 |
| 2992 | 1062 |
| 2993 | 1066 |
| 2994 | 1077 |
| 2995 | 1102 |
| 2996 | 1145 |
| 2997 | 1160 |
| 2998 | 1201 |
| 2999 | 1234 |
| 3000 | 1376 |
| 3001 | 1478 |
| 3002 | 1557 |
| 3003 | 1627 |
| 3004 | 1725 |
| 3005 | 1789 |
| 3006 | 1818 |
| 3007 | 1839 |
| 3008 | 1862 |
| 3009 | 1839 |
| 3010 | 1822 |
| 3011 | 1818 |
| 3012 | 1809 |
| 3013 | 1788 |
| 3014 | 1808 |
| 3015 | 1796 |
| 3016 | 1773 |
| 3017 | 1752 |
| 3018 | 1764 |
| 3019 | 1752 |
| 3020 | 1730 |
| 3021 | 1790 |
| 3022 | 1868 |
| 3023 | 1903 |
| 3024 | 1909 |
| 3025 | 1907 |
| 3026 | 1901 |
| 3027 | 1899 |
| 3028 | 1855 |
| 3029 | 1842 |
| 3030 | 1871 |
| 3031 | 1856 |
| 3032 | 1850 |
| 3033 | 1834 |
| 3034 | 1809 |
| 3035 | 1826 |
| 3036 | 1864 |
| 3037 | 1871 |
| 3038 | 1859 |
| 3039 | 1862 |
| 3040 | 1902 |
| 3041 | 1940 |
| 3042 | 1968 |
| 3043 | 2018 |
| 3044 | 2082 |
| 3045 | 2192 |
| 3046 | 2292 |
| 3047 | 2373 |
| 3048 | 2393 |
| 3049 | 2395 |
| 3050 | 2394 |
| 3051 | 2380 |
| 3052 | 2343 |
| 3053 | 2307 |
| 3054 | 2263 |
| 3055 | 2222 |
| 3056 | 2168 |
| 3057 | 2080 |
| 3058 | 2006 |
| 3059 | 1937 |
| 3060 | 1910 |
| 3061 | 1870 |
| 3062 | 1890 |
| 3063 | 1871 |
| 3064 | 1785 |
| 3065 | 1703 |
| 3066 | 1621 |
| 3067 | 1535 |
| 3068 | 1445 |
| 3069 | 1366 |
| 3070 | 1296 |
| 3071 | 1238 |
| 3072 | 1275 |
| 3073 | 1289 |
| 3074 | 1253 |
| 3075 | 1221 |
| 3076 | 1190 |
| 3077 | 1162 |
| 3078 | 1130 |
| 3079 | 1104 |
| 3080 | 1089 |
| 3081 | 1071 |
| 3082 | 1064 |
| 3083 | 1055 |
| 3084 | 1048 |
| 3085 | 1036 |
| 3086 | 1042 |
| 3087 | 1045 |
| 3088 | 1069 |
| 3089 | 1077 |
| 3090 | 1097 |
| 3091 | 1124 |
| 3092 | 1161 |
| 3093 | 1177 |
| 3094 | 1214 |
| 3095 | 1248 |
| 3096 | 1382 |
| 3097 | 1478 |
| 3098 | 1559 |
| 3099 | 1638 |
| 3100 | 1734 |
| 3101 | 1791 |
| 3102 | 1823 |
| 3103 | 1837 |
| 3104 | 1872 |
| 3105 | 1879 |
| 3106 | 1878 |
| 3107 | 1846 |
| 3108 | 1804 |
| 3109 | 1786 |
| 3110 | 1789 |
| 3111 | 1793 |
| 3112 | 1791 |
| 3113 | 1792 |
| 3114 | 1815 |
| 3115 | 1812 |
| 3116 | 1808 |
| 3117 | 1813 |
| 3118 | 1805 |
| 3119 | 1796 |
| 3120 | 1802 |
| 3121 | 1788 |
| 3122 | 1739 |
| 3123 | 1727 |
| 3124 | 1673 |
| 3125 | 1643 |
| 3126 | 1649 |
| 3127 | 1681 |
| 3128 | 1667 |
| 3129 | 1656 |
| 3130 | 1629 |
| 3131 | 1645 |
| 3132 | 1664 |
| 3133 | 1666 |
| 3134 | 1697 |
| 3135 | 1720 |
| 3136 | 1747 |
| 3137 | 1772 |
| 3138 | 1787 |
| 3139 | 1831 |
| 3140 | 1914 |
| 3141 | 2025 |
| 3142 | 2171 |
| 3143 | 2303 |
| 3144 | 2360 |
| 3145 | 2370 |
| 3146 | 2363 |
| 3147 | 2360 |
| 3148 | 2320 |
| 3149 | 2278 |
| 3150 | 2237 |
| 3151 | 2198 |
| 3152 | 2144 |
| 3153 | 2066 |
| 3154 | 2003 |
| 3155 | 1943 |
| 3156 | 1923 |
| 3157 | 1885 |
| 3158 | 1904 |
| 3159 | 1875 |
| 3160 | 1787 |
| 3161 | 1706 |
| 3162 | 1624 |
| 3163 | 1543 |
| 3164 | 1454 |
| 3165 | 1376 |
| 3166 | 1307 |
| 3167 | 1245 |
| 3168 | 1292 |
| 3169 | 1302 |
| 3170 | 1261 |
| 3171 | 1225 |
| 3172 | 1200 |
| 3173 | 1172 |
| 3174 | 1150 |
| 3175 | 1124 |
| 3176 | 1106 |
| 3177 | 1083 |
| 3178 | 1073 |
| 3179 | 1064 |
| 3180 | 1051 |
| 3181 | 1040 |
| 3182 | 1038 |
| 3183 | 1041 |
| 3184 | 1065 |
| 3185 | 1069 |
| 3186 | 1085 |
| 3187 | 1115 |
| 3188 | 1149 |
| 3189 | 1167 |
| 3190 | 1207 |
| 3191 | 1237 |
| 3192 | 1374 |
| 3193 | 1471 |
| 3194 | 1548 |
| 3195 | 1638 |
| 3196 | 1728 |
| 3197 | 1783 |
| 3198 | 1813 |
| 3199 | 1841 |
| 3200 | 1863 |
| 3201 | 1865 |
| 3202 | 1851 |
| 3203 | 1829 |
| 3204 | 1792 |
| 3205 | 1784 |
| 3206 | 1798 |
| 3207 | 1806 |
| 3208 | 1805 |
| 3209 | 1792 |
| 3210 | 1825 |
| 3211 | 1790 |
| 3212 | 1756 |
| 3213 | 1798 |
| 3214 | 1862 |
| 3215 | 1836 |
| 3216 | 1801 |
| 3217 | 1805 |
| 3218 | 1781 |
| 3219 | 1811 |
| 3220 | 1808 |
| 3221 | 1834 |
| 3222 | 1885 |
| 3223 | 1867 |
| 3224 | 1873 |
| 3225 | 1893 |
| 3226 | 1912 |
| 3227 | 1881 |
| 3228 | 1835 |
| 3229 | 1806 |
| 3230 | 1798 |
| 3231 | 1804 |
| 3232 | 1839 |
| 3233 | 1866 |
| 3234 | 1903 |
| 3235 | 1975 |
| 3236 | 2047 |
| 3237 | 2136 |
| 3238 | 2233 |
| 3239 | 2328 |
| 3240 | 2373 |
| 3241 | 2383 |
| 3242 | 2376 |
| 3243 | 2364 |
| 3244 | 2333 |
| 3245 | 2287 |
| 3246 | 2246 |
| 3247 | 2208 |
| 3248 | 2141 |
| 3249 | 2056 |
| 3250 | 1980 |
| 3251 | 1924 |
| 3252 | 1916 |
| 3253 | 1879 |
| 3254 | 1896 |
| 3255 | 1871 |
| 3256 | 1784 |
| 3257 | 1706 |
| 3258 | 1626 |
| 3259 | 1540 |
| 3260 | 1447 |
| 3261 | 1368 |
| 3262 | 1295 |
| 3263 | 1228 |
| 3264 | 1269 |
| 3265 | 1282 |
| 3266 | 1234 |
| 3267 | 1196 |
| 3268 | 1160 |
| 3269 | 1129 |
| 3270 | 1103 |
| 3271 | 1081 |
| 3272 | 1056 |
| 3273 | 1040 |
| 3274 | 1034 |
| 3275 | 1030 |
| 3276 | 1027 |
| 3277 | 1018 |
| 3278 | 1026 |
| 3279 | 1029 |
| 3280 | 1056 |
| 3281 | 1063 |
| 3282 | 1081 |
| 3283 | 1098 |
| 3284 | 1137 |
| 3285 | 1142 |
| 3286 | 1182 |
| 3287 | 1221 |
| 3288 | 1363 |
| 3289 | 1445 |
| 3290 | 1528 |
| 3291 | 1611 |
| 3292 | 1701 |
| 3293 | 1752 |
| 3294 | 1790 |
| 3295 | 1788 |
| 3296 | 1815 |
| 3297 | 1809 |
| 3298 | 1759 |
| 3299 | 1725 |
| 3300 | 1706 |
| 3301 | 1741 |
| 3302 | 1760 |
| 3303 | 1719 |
| 3304 | 1672 |
| 3305 | 1668 |
| 3306 | 1691 |
| 3307 | 1699 |
| 3308 | 1690 |
| 3309 | 1726 |
| 3310 | 1746 |
| 3311 | 1741 |
| 3312 | 1710 |
| 3313 | 1640 |
| 3314 | 1621 |
| 3315 | 1659 |
| 3316 | 1672 |
| 3317 | 1686 |
| 3318 | 1732 |
| 3319 | 1723 |
| 3320 | 1716 |
| 3321 | 1700 |
| 3322 | 1691 |
| 3323 | 1708 |
| 3324 | 1722 |
| 3325 | 1733 |
| 3326 | 1707 |
| 3327 | 1709 |
| 3328 | 1769 |
| 3329 | 1834 |
| 3330 | 1870 |
| 3331 | 1919 |
| 3332 | 1985 |
| 3333 | 2058 |
| 3334 | 2175 |
| 3335 | 2289 |
| 3336 | 2307 |
| 3337 | 2323 |
| 3338 | 2324 |
| 3339 | 2307 |
| 3340 | 2278 |
| 3341 | 2226 |
| 3342 | 2183 |
| 3343 | 2161 |
| 3344 | 2100 |
| 3345 | 2016 |
| 3346 | 1944 |
| 3347 | 1886 |
| 3348 | 1883 |
| 3349 | 1840 |
| 3350 | 1861 |
| 3351 | 1854 |
| 3352 | 1759 |
| 3353 | 1677 |
| 3354 | 1598 |
| 3355 | 1513 |
| 3356 | 1423 |
| 3357 | 1347 |
| 3358 | 1280 |
| 3359 | 1224 |
| 3360 | 1258 |
| 3361 | 1278 |
| 3362 | 1236 |
| 3363 | 1198 |
| 3364 | 1167 |
| 3365 | 1127 |
| 3366 | 1096 |
| 3367 | 1077 |
| 3368 | 1061 |
| 3369 | 1046 |
| 3370 | 1028 |
| 3371 | 1019 |
| 3372 | 1020 |
| 3373 | 1022 |
| 3374 | 1024 |
| 3375 | 1021 |
| 3376 | 1044 |
| 3377 | 1051 |
| 3378 | 1076 |
| 3379 | 1097 |
| 3380 | 1134 |
| 3381 | 1147 |
| 3382 | 1187 |
| 3383 | 1217 |
| 3384 | 1343 |
| 3385 | 1441 |
| 3386 | 1532 |
| 3387 | 1610 |
| 3388 | 1715 |
| 3389 | 1766 |
| 3390 | 1814 |
| 3391 | 1819 |
| 3392 | 1856 |
| 3393 | 1863 |
| 3394 | 1824 |
| 3395 | 1801 |
| 3396 | 1751 |
| 3397 | 1703 |
| 3398 | 1659 |
| 3399 | 1675 |
| 3400 | 1737 |
| 3401 | 1749 |
| 3402 | 1754 |
| 3403 | 1758 |
| 3404 | 1749 |
| 3405 | 1751 |
| 3406 | 1678 |
| 3407 | 1669 |
| 3408 | 1641 |
| 3409 | 1608 |
| 3410 | 1583 |
| 3411 | 1570 |
| 3412 | 1543 |
| 3413 | 1554 |
| 3414 | 1569 |
| 3415 | 1558 |
| 3416 | 1582 |
| 3417 | 1606 |
| 3418 | 1625 |
| 3419 | 1631 |
| 3420 | 1625 |
| 3421 | 1648 |
| 3422 | 1681 |
| 3423 | 1708 |
| 3424 | 1744 |
| 3425 | 1784 |
| 3426 | 1816 |
| 3427 | 1872 |
| 3428 | 1944 |
| 3429 | 2020 |
| 3430 | 2105 |
| 3431 | 2222 |
| 3432 | 2281 |
| 3433 | 2296 |
| 3434 | 2294 |
| 3435 | 2279 |
| 3436 | 2236 |
| 3437 | 2193 |
| 3438 | 2151 |
| 3439 | 2103 |
| 3440 | 2058 |
| 3441 | 1987 |
| 3442 | 1917 |
| 3443 | 1859 |
| 3444 | 1859 |
| 3445 | 1829 |
| 3446 | 1860 |
| 3447 | 1857 |
| 3448 | 1787 |
| 3449 | 1723 |
| 3450 | 1660 |
| 3451 | 1595 |
| 3452 | 1508 |
| 3453 | 1443 |
| 3454 | 1372 |
| 3455 | 1309 |
| 3456 | 1339 |
| 3457 | 1342 |
| 3458 | 1302 |
| 3459 | 1259 |
| 3460 | 1225 |
| 3461 | 1187 |
| 3462 | 1152 |
| 3463 | 1128 |
| 3464 | 1101 |
| 3465 | 1074 |
| 3466 | 1059 |
| 3467 | 1048 |
| 3468 | 1046 |
| 3469 | 1042 |
| 3470 | 1035 |
| 3471 | 1025 |
| 3472 | 1036 |
| 3473 | 1027 |
| 3474 | 1024 |
| 3475 | 1025 |
| 3476 | 1031 |
| 3477 | 1018 |
| 3478 | 1025 |
| 3479 | 1007 |
| 3480 | 1076 |
| 3481 | 1115 |
| 3482 | 1156 |
| 3483 | 1189 |
| 3484 | 1253 |
| 3485 | 1322 |
| 3486 | 1373 |
| 3487 | 1411 |
| 3488 | 1476 |
| 3489 | 1526 |
| 3490 | 1586 |
| 3491 | 1634 |
| 3492 | 1692 |
| 3493 | 1720 |
| 3494 | 1749 |
| 3495 | 1778 |
| 3496 | 1811 |
| 3497 | 1806 |
| 3498 | 1802 |
| 3499 | 1806 |
| 3500 | 1788 |
| 3501 | 1777 |
| 3502 | 1810 |
| 3503 | 1836 |
| 3504 | 1834 |
| 3505 | 1808 |
| 3506 | 1800 |
| 3507 | 1762 |
| 3508 | 1733 |
| 3509 | 1739 |
| 3510 | 1770 |
| 3511 | 1766 |
| 3512 | 1762 |
| 3513 | 1737 |
| 3514 | 1749 |
| 3515 | 1743 |
| 3516 | 1742 |
| 3517 | 1752 |
| 3518 | 1762 |
| 3519 | 1774 |
| 3520 | 1794 |
| 3521 | 1822 |
| 3522 | 1843 |
| 3523 | 1897 |
| 3524 | 1960 |
| 3525 | 2044 |
| 3526 | 2149 |
| 3527 | 2226 |
| 3528 | 2249 |
| 3529 | 2252 |
| 3530 | 2241 |
| 3531 | 2200 |
| 3532 | 2146 |
| 3533 | 2101 |
| 3534 | 2053 |
| 3535 | 2013 |
| 3536 | 1961 |
| 3537 | 1889 |
| 3538 | 1819 |
| 3539 | 1765 |
| 3540 | 1758 |
| 3541 | 1717 |
| 3542 | 1745 |
| 3543 | 1727 |
| 3544 | 1671 |
| 3545 | 1626 |
| 3546 | 1566 |
| 3547 | 1515 |
| 3548 | 1446 |
| 3549 | 1376 |
| 3550 | 1306 |
| 3551 | 1249 |
| 3552 | 1288 |
| 3553 | 1299 |
| 3554 | 1257 |
| 3555 | 1215 |
| 3556 | 1169 |
| 3557 | 1121 |
| 3558 | 1076 |
| 3559 | 1048 |
| 3560 | 1026 |
| 3561 | 1001 |
| 3562 | 980 |
| 3563 | 964 |
| 3564 | 953 |
| 3565 | 939 |
| 3566 | 938 |
| 3567 | 938 |
| 3568 | 937 |
| 3569 | 929 |
| 3570 | 928 |
| 3571 | 932 |
| 3572 | 933 |
| 3573 | 916 |
| 3574 | 914 |
| 3575 | 886 |
| 3576 | 917 |
| 3577 | 930 |
| 3578 | 952 |
| 3579 | 980 |
| 3580 | 1034 |
| 3581 | 1072 |
| 3582 | 1091 |
| 3583 | 1138 |
| 3584 | 1199 |
| 3585 | 1264 |
| 3586 | 1327 |
| 3587 | 1371 |
| 3588 | 1407 |
| 3589 | 1443 |
| 3590 | 1487 |
| 3591 | 1504 |
| 3592 | 1509 |
| 3593 | 1560 |
| 3594 | 1631 |
| 3595 | 1702 |
| 3596 | 1724 |
| 3597 | 1751 |
| 3598 | 1727 |
| 3599 | 1767 |
| 3600 | 1698 |
| 3601 | 1570 |
| 3602 | 1519 |
| 3603 | 1517 |
| 3604 | 1465 |
| 3605 | 1369 |
| 3606 | 1351 |
| 3607 | 1385 |
| 3608 | 1333 |
| 3609 | 1303 |
| 3610 | 1405 |
| 3611 | 1399 |
| 3612 | 1385 |
| 3613 | 1389 |
| 3614 | 1351 |
| 3615 | 1364 |
| 3616 | 1408 |
| 3617 | 1441 |
| 3618 | 1476 |
| 3619 | 1554 |
| 3620 | 1644 |
| 3621 | 1735 |
| 3622 | 1849 |
| 3623 | 1970 |
| 3624 | 2070 |
| 3625 | 2118 |
| 3626 | 2122 |
| 3627 | 2102 |
| 3628 | 2069 |
| 3629 | 2035 |
| 3630 | 2006 |
| 3631 | 1974 |
| 3632 | 1936 |
| 3633 | 1867 |
| 3634 | 1798 |
| 3635 | 1736 |
| 3636 | 1721 |
| 3637 | 1709 |
| 3638 | 1734 |
| 3639 | 1746 |
| 3640 | 1674 |
| 3641 | 1595 |
| 3642 | 1520 |
| 3643 | 1454 |
| 3644 | 1372 |
| 3645 | 1299 |
| 3646 | 1239 |
| 3647 | 1185 |
| 3648 | 1230 |
| 3649 | 1250 |
| 3650 | 1208 |
| 3651 | 1181 |
| 3652 | 1159 |
| 3653 | 1130 |
| 3654 | 1102 |
| 3655 | 1080 |
| 3656 | 1065 |
| 3657 | 1050 |
| 3658 | 1037 |
| 3659 | 1030 |
| 3660 | 1027 |
| 3661 | 1017 |
| 3662 | 1019 |
| 3663 | 1021 |
| 3664 | 1047 |
| 3665 | 1051 |
| 3666 | 1063 |
| 3667 | 1095 |
| 3668 | 1143 |
| 3669 | 1162 |
| 3670 | 1208 |
| 3671 | 1236 |
| 3672 | 1379 |
| 3673 | 1480 |
| 3674 | 1561 |
| 3675 | 1638 |
| 3676 | 1726 |
| 3677 | 1763 |
| 3678 | 1778 |
| 3679 | 1792 |
| 3680 | 1810 |
| 3681 | 1780 |
| 3682 | 1757 |
| 3683 | 1735 |
| 3684 | 1696 |
| 3685 | 1681 |
| 3686 | 1695 |
| 3687 | 1686 |
| 3688 | 1669 |
| 3689 | 1645 |
| 3690 | 1609 |
| 3691 | 1558 |
| 3692 | 1519 |
| 3693 | 1608 |
| 3694 | 1664 |
| 3695 | 1688 |
| 3696 | 1679 |
| 3697 | 1662 |
| 3698 | 1637 |
| 3699 | 1641 |
| 3700 | 1647 |
| 3701 | 1652 |
| 3702 | 1667 |
| 3703 | 1662 |
| 3704 | 1673 |
| 3705 | 1689 |
| 3706 | 1679 |
| 3707 | 1656 |
| 3708 | 1673 |
| 3709 | 1693 |
| 3710 | 1710 |
| 3711 | 1738 |
| 3712 | 1768 |
| 3713 | 1802 |
| 3714 | 1833 |
| 3715 | 1889 |
| 3716 | 1958 |
| 3717 | 2048 |
| 3718 | 2153 |
| 3719 | 2258 |
| 3720 | 2329 |
| 3721 | 2355 |
| 3722 | 2366 |
| 3723 | 2355 |
| 3724 | 2318 |
| 3725 | 2282 |
| 3726 | 2241 |
| 3727 | 2195 |
| 3728 | 2137 |
| 3729 | 2055 |
| 3730 | 1986 |
| 3731 | 1914 |
| 3732 | 1898 |
| 3733 | 1852 |
| 3734 | 1865 |
| 3735 | 1844 |
| 3736 | 1761 |
| 3737 | 1672 |
| 3738 | 1590 |
| 3739 | 1505 |
| 3740 | 1416 |
| 3741 | 1333 |
| 3742 | 1264 |
| 3743 | 1205 |
| 3744 | 1245 |
| 3745 | 1261 |
| 3746 | 1226 |
| 3747 | 1196 |
| 3748 | 1165 |
| 3749 | 1138 |
| 3750 | 1110 |
| 3751 | 1087 |
| 3752 | 1070 |
| 3753 | 1055 |
| 3754 | 1044 |
| 3755 | 1039 |
| 3756 | 1037 |
| 3757 | 1029 |
| 3758 | 1030 |
| 3759 | 1034 |
| 3760 | 1057 |
| 3761 | 1066 |
| 3762 | 1087 |
| 3763 | 1112 |
| 3764 | 1151 |
| 3765 | 1168 |
| 3766 | 1209 |
| 3767 | 1245 |
| 3768 | 1375 |
| 3769 | 1467 |
| 3770 | 1547 |
| 3771 | 1621 |
| 3772 | 1725 |
| 3773 | 1761 |
| 3774 | 1779 |
| 3775 | 1798 |
| 3776 | 1837 |
| 3777 | 1847 |
| 3778 | 1853 |
| 3779 | 1834 |
| 3780 | 1809 |
| 3781 | 1804 |
| 3782 | 1824 |
| 3783 | 1839 |
| 3784 | 1852 |
| 3785 | 1850 |
| 3786 | 1818 |
| 3787 | 1771 |
| 3788 | 1728 |
| 3789 | 1703 |
| 3790 | 1694 |
| 3791 | 1776 |
| 3792 | 1791 |
| 3793 | 1740 |
| 3794 | 1693 |
| 3795 | 1642 |
| 3796 | 1614 |
| 3797 | 1631 |
| 3798 | 1654 |
| 3799 | 1719 |
| 3800 | 1709 |
| 3801 | 1695 |
| 3802 | 1659 |
| 3803 | 1642 |
| 3804 | 1652 |
| 3805 | 1662 |
| 3806 | 1685 |
| 3807 | 1707 |
| 3808 | 1745 |
| 3809 | 1771 |
| 3810 | 1776 |
| 3811 | 1814 |
| 3812 | 1879 |
| 3813 | 1973 |
| 3814 | 2092 |
| 3815 | 2226 |
| 3816 | 2314 |
| 3817 | 2345 |
| 3818 | 2344 |
| 3819 | 2345 |
| 3820 | 2308 |
| 3821 | 2263 |
| 3822 | 2223 |
| 3823 | 2187 |
| 3824 | 2129 |
| 3825 | 2046 |
| 3826 | 1987 |
| 3827 | 1926 |
| 3828 | 1909 |
| 3829 | 1870 |
| 3830 | 1884 |
| 3831 | 1855 |
| 3832 | 1764 |
| 3833 | 1687 |
| 3834 | 1606 |
| 3835 | 1520 |
| 3836 | 1427 |
| 3837 | 1345 |
| 3838 | 1276 |
| 3839 | 1215 |
| 3840 | 1258 |
| 3841 | 1274 |
| 3842 | 1233 |
| 3843 | 1200 |
| 3844 | 1177 |
| 3845 | 1145 |
| 3846 | 1123 |
| 3847 | 1096 |
| 3848 | 1077 |
| 3849 | 1051 |
| 3850 | 1035 |
| 3851 | 1033 |
| 3852 | 1024 |
| 3853 | 1013 |
| 3854 | 1011 |
| 3855 | 1017 |
| 3856 | 1041 |
| 3857 | 1047 |
| 3858 | 1066 |
| 3859 | 1096 |
| 3860 | 1131 |
| 3861 | 1149 |
| 3862 | 1188 |
| 3863 | 1223 |
| 3864 | 1357 |
| 3865 | 1450 |
| 3866 | 1529 |
| 3867 | 1616 |
| 3868 | 1713 |
| 3869 | 1759 |
| 3870 | 1769 |
| 3871 | 1791 |
| 3872 | 1825 |
| 3873 | 1820 |
| 3874 | 1802 |
| 3875 | 1771 |
| 3876 | 1717 |
| 3877 | 1712 |
| 3878 | 1729 |
| 3879 | 1739 |
| 3880 | 1728 |
| 3881 | 1695 |
| 3882 | 1712 |
| 3883 | 1645 |
| 3884 | 1566 |
| 3885 | 1602 |
| 3886 | 1706 |
| 3887 | 1667 |
| 3888 | 1636 |
| 3889 | 1637 |
| 3890 | 1615 |
| 3891 | 1619 |
| 3892 | 1628 |
| 3893 | 1708 |
| 3894 | 1782 |
| 3895 | 1767 |
| 3896 | 1784 |
| 3897 | 1818 |
| 3898 | 1839 |
| 3899 | 1798 |
| 3900 | 1736 |
| 3901 | 1669 |
| 3902 | 1660 |
| 3903 | 1664 |
| 3904 | 1720 |
| 3905 | 1767 |
| 3906 | 1792 |
| 3907 | 1848 |
| 3908 | 1918 |
| 3909 | 2004 |
| 3910 | 2100 |
| 3911 | 2208 |
| 3912 | 2300 |
| 3913 | 2346 |
| 3914 | 2351 |
| 3915 | 2348 |
| 3916 | 2317 |
| 3917 | 2264 |
| 3918 | 2224 |
| 3919 | 2175 |
| 3920 | 2116 |
| 3921 | 2037 |
| 3922 | 1964 |
| 3923 | 1904 |
| 3924 | 1889 |
| 3925 | 1850 |
| 3926 | 1866 |
| 3927 | 1837 |
| 3928 | 1751 |
| 3929 | 1679 |
| 3930 | 1596 |
| 3931 | 1506 |
| 3932 | 1410 |
| 3933 | 1326 |
| 3934 | 1251 |
| 3935 | 1186 |
| 3936 | 1218 |
| 3937 | 1226 |
| 3938 | 1182 |
| 3939 | 1146 |
| 3940 | 1114 |
| 3941 | 1084 |
| 3942 | 1060 |
| 3943 | 1037 |
| 3944 | 1013 |
| 3945 | 999 |
| 3946 | 991 |
| 3947 | 990 |
| 3948 | 988 |
| 3949 | 980 |
| 3950 | 985 |
| 3951 | 986 |
| 3952 | 1012 |
| 3953 | 1018 |
| 3954 | 1039 |
| 3955 | 1057 |
| 3956 | 1100 |
| 3957 | 1108 |
| 3958 | 1147 |
| 3959 | 1190 |
| 3960 | 1331 |
| 3961 | 1423 |
| 3962 | 1510 |
| 3963 | 1587 |
| 3964 | 1674 |
| 3965 | 1706 |
| 3966 | 1732 |
| 3967 | 1743 |
| 3968 | 1774 |
| 3969 | 1769 |
| 3970 | 1727 |
| 3971 | 1698 |
| 3972 | 1692 |
| 3973 | 1730 |
| 3974 | 1753 |
| 3975 | 1729 |
| 3976 | 1687 |
| 3977 | 1686 |
| 3978 | 1709 |
| 3979 | 1739 |
| 3980 | 1747 |
| 3981 | 1796 |
| 3982 | 1818 |
| 3983 | 1807 |
| 3984 | 1771 |
| 3985 | 1676 |
| 3986 | 1671 |
| 3987 | 1734 |
| 3988 | 1773 |
| 3989 | 1735 |
| 3990 | 1732 |
| 3991 | 1682 |
| 3992 | 1647 |
| 3993 | 1612 |
| 3994 | 1596 |
| 3995 | 1617 |
| 3996 | 1669 |
| 3997 | 1696 |
| 3998 | 1669 |
| 3999 | 1667 |
| 4000 | 1715 |
| 4001 | 1768 |
| 4002 | 1785 |
| 4003 | 1821 |
| 4004 | 1879 |
| 4005 | 1955 |
| 4006 | 2054 |
| 4007 | 2179 |
| 4008 | 2229 |
| 4009 | 2276 |
| 4010 | 2293 |
| 4011 | 2279 |
| 4012 | 2249 |
| 4013 | 2198 |
| 4014 | 2157 |
| 4015 | 2121 |
| 4016 | 2057 |
| 4017 | 1975 |
| 4018 | 1902 |
| 4019 | 1847 |
| 4020 | 1843 |
| 4021 | 1793 |
| 4022 | 1810 |
| 4023 | 1794 |
| 4024 | 1704 |
| 4025 | 1621 |
| 4026 | 1542 |
| 4027 | 1460 |
| 4028 | 1367 |
| 4029 | 1290 |
| 4030 | 1222 |
| 4031 | 1162 |
| 4032 | 1199 |
| 4033 | 1213 |
| 4034 | 1169 |
| 4035 | 1132 |
| 4036 | 1100 |
| 4037 | 1057 |
| 4038 | 1021 |
| 4039 | 1001 |
| 4040 | 987 |
| 4041 | 972 |
| 4042 | 959 |
| 4043 | 947 |
| 4044 | 950 |
| 4045 | 949 |
| 4046 | 951 |
| 4047 | 952 |
| 4048 | 977 |
| 4049 | 985 |
| 4050 | 1007 |
| 4051 | 1032 |
| 4052 | 1067 |
| 4053 | 1080 |
| 4054 | 1124 |
| 4055 | 1165 |
| 4056 | 1289 |
| 4057 | 1389 |
| 4058 | 1475 |
| 4059 | 1551 |
| 4060 | 1653 |
| 4061 | 1682 |
| 4062 | 1714 |
| 4063 | 1731 |
| 4064 | 1772 |
| 4065 | 1770 |
| 4066 | 1732 |
| 4067 | 1683 |
| 4068 | 1607 |
| 4069 | 1559 |
| 4070 | 1562 |
| 4071 | 1593 |
| 4072 | 1650 |
| 4073 | 1697 |
| 4074 | 1724 |
| 4075 | 1741 |
| 4076 | 1753 |
| 4077 | 1780 |
| 4078 | 1727 |
| 4079 | 1757 |
| 4080 | 1745 |
| 4081 | 1724 |
| 4082 | 1689 |
| 4083 | 1682 |
| 4084 | 1655 |
| 4085 | 1645 |
| 4086 | 1663 |
| 4087 | 1660 |
| 4088 | 1634 |
| 4089 | 1662 |
| 4090 | 1689 |
| 4091 | 1664 |
| 4092 | 1642 |
| 4093 | 1663 |
| 4094 | 1668 |
| 4095 | 1666 |
| 4096 | 1669 |
| 4097 | 1690 |
| 4098 | 1723 |
| 4099 | 1765 |
| 4100 | 1831 |
| 4101 | 1904 |
| 4102 | 1982 |
| 4103 | 2101 |
| 4104 | 2187 |
| 4105 | 2247 |
| 4106 | 2251 |
| 4107 | 2243 |
| 4108 | 2211 |
| 4109 | 2168 |
| 4110 | 2126 |
| 4111 | 2081 |
| 4112 | 2026 |
| 4113 | 1956 |
| 4114 | 1882 |
| 4115 | 1826 |
| 4116 | 1823 |
| 4117 | 1794 |
| 4118 | 1817 |
| 4119 | 1804 |
| 4120 | 1739 |
| 4121 | 1678 |
| 4122 | 1621 |
| 4123 | 1551 |
| 4124 | 1464 |
| 4125 | 1390 |
| 4126 | 1318 |
| 4127 | 1254 |
| 4128 | 1280 |
| 4129 | 1289 |
| 4130 | 1248 |
| 4131 | 1210 |
| 4132 | 1174 |
| 4133 | 1133 |
| 4134 | 1096 |
| 4135 | 1078 |
| 4136 | 1060 |
| 4137 | 1038 |
| 4138 | 1022 |
| 4139 | 1008 |
| 4140 | 1012 |
| 4141 | 1008 |
| 4142 | 1003 |
| 4143 | 995 |
| 4144 | 1002 |
| 4145 | 996 |
| 4146 | 992 |
| 4147 | 996 |
| 4148 | 1007 |
| 4149 | 997 |
| 4150 | 1006 |
| 4151 | 992 |
| 4152 | 1058 |
| 4153 | 1099 |
| 4154 | 1143 |
| 4155 | 1179 |
| 4156 | 1234 |
| 4157 | 1289 |
| 4158 | 1333 |
| 4159 | 1384 |
| 4160 | 1438 |
| 4161 | 1472 |
| 4162 | 1536 |
| 4163 | 1571 |
| 4164 | 1618 |
| 4165 | 1625 |
| 4166 | 1647 |
| 4167 | 1656 |
| 4168 | 1721 |
| 4169 | 1717 |
| 4170 | 1756 |
| 4171 | 1796 |
| 4172 | 1786 |
| 4173 | 1795 |
| 4174 | 1818 |
| 4175 | 1859 |
| 4176 | 1852 |
| 4177 | 1793 |
| 4178 | 1796 |
| 4179 | 1738 |
| 4180 | 1648 |
| 4181 | 1618 |
| 4182 | 1700 |
| 4183 | 1719 |
| 4184 | 1734 |
| 4185 | 1702 |
| 4186 | 1692 |
| 4187 | 1679 |
| 4188 | 1677 |
| 4189 | 1689 |
| 4190 | 1695 |
| 4191 | 1697 |
| 4192 | 1712 |
| 4193 | 1744 |
| 4194 | 1766 |
| 4195 | 1820 |
| 4196 | 1884 |
| 4197 | 1954 |
| 4198 | 2057 |
| 4199 | 2142 |
| 4200 | 2185 |
| 4201 | 2220 |
| 4202 | 2218 |
| 4203 | 2178 |
| 4204 | 2122 |
| 4205 | 2075 |
| 4206 | 2023 |
| 4207 | 1984 |
| 4208 | 1942 |
| 4209 | 1864 |
| 4210 | 1782 |
| 4211 | 1733 |
| 4212 | 1727 |
| 4213 | 1689 |
| 4214 | 1714 |
| 4215 | 1696 |
| 4216 | 1637 |
| 4217 | 1596 |
| 4218 | 1541 |
| 4219 | 1483 |
| 4220 | 1416 |
| 4221 | 1349 |
| 4222 | 1278 |
| 4223 | 1223 |
| 4224 | 1254 |
| 4225 | 1260 |
| 4226 | 1220 |
| 4227 | 1180 |
| 4228 | 1139 |
| 4229 | 1089 |
| 4230 | 1049 |
| 4231 | 1019 |
| 4232 | 999 |
| 4233 | 978 |
| 4234 | 957 |
| 4235 | 940 |
| 4236 | 933 |
| 4237 | 922 |
| 4238 | 917 |
| 4239 | 918 |
| 4240 | 914 |
| 4241 | 910 |
| 4242 | 911 |
| 4243 | 913 |
| 4244 | 916 |
| 4245 | 902 |
| 4246 | 900 |
| 4247 | 873 |
| 4248 | 907 |
| 4249 | 916 |
| 4250 | 940 |
| 4251 | 970 |
| 4252 | 1014 |
| 4253 | 1038 |
| 4254 | 1058 |
| 4255 | 1115 |
| 4256 | 1176 |
| 4257 | 1232 |
| 4258 | 1278 |
| 4259 | 1320 |
| 4260 | 1347 |
| 4261 | 1379 |
| 4262 | 1414 |
| 4263 | 1408 |
| 4264 | 1404 |
| 4265 | 1419 |
| 4266 | 1460 |
| 4267 | 1501 |
| 4268 | 1501 |
| 4269 | 1527 |
| 4270 | 1514 |
| 4271 | 1559 |
| 4272 | 1475 |
| 4273 | 1321 |
| 4274 | 1286 |
| 4275 | 1309 |
| 4276 | 1253 |
| 4277 | 1128 |
| 4278 | 1097 |
| 4279 | 1151 |
| 4280 | 1092 |
| 4281 | 1052 |
| 4282 | 1151 |
| 4283 | 1160 |
| 4284 | 1167 |
| 4285 | 1181 |
| 4286 | 1163 |
| 4287 | 1205 |
| 4288 | 1268 |
| 4289 | 1316 |
| 4290 | 1345 |
| 4291 | 1430 |
| 4292 | 1535 |
| 4293 | 1638 |
| 4294 | 1739 |
| 4295 | 1850 |
| 4296 | 1972 |
| 4297 | 2071 |
| 4298 | 2084 |
| 4299 | 2077 |
| 4300 | 2047 |
| 4301 | 2019 |
| 4302 | 1988 |
| 4303 | 1953 |
| 4304 | 1912 |
| 4305 | 1845 |
| 4306 | 1772 |
| 4307 | 1712 |
| 4308 | 1694 |
| 4309 | 1674 |
| 4310 | 1701 |
| 4311 | 1704 |
| 4312 | 1636 |
| 4313 | 1559 |
| 4314 | 1484 |
| 4315 | 1420 |
| 4316 | 1338 |
| 4317 | 1259 |
| 4318 | 1201 |
| 4319 | 1149 |
| 4320 | 1185 |
| 4321 | 1206 |
| 4322 | 1164 |
| 4323 | 1135 |
| 4324 | 1112 |
| 4325 | 1084 |
| 4326 | 1061 |
| 4327 | 1045 |
| 4328 | 1031 |
| 4329 | 1016 |
| 4330 | 1002 |
| 4331 | 995 |
| 4332 | 996 |
| 4333 | 987 |
| 4334 | 986 |
| 4335 | 986 |
| 4336 | 1010 |
| 4337 | 1018 |
| 4338 | 1030 |
| 4339 | 1061 |
| 4340 | 1110 |
| 4341 | 1132 |
| 4342 | 1180 |
| 4343 | 1217 |
| 4344 | 1358 |
| 4345 | 1456 |
| 4346 | 1540 |
| 4347 | 1614 |
| 4348 | 1686 |
| 4349 | 1705 |
| 4350 | 1706 |
| 4351 | 1722 |
| 4352 | 1727 |
| 4353 | 1681 |
| 4354 | 1642 |
| 4355 | 1606 |
| 4356 | 1548 |
| 4357 | 1519 |
| 4358 | 1519 |
| 4359 | 1488 |
| 4360 | 1452 |
| 4361 | 1413 |
| 4362 | 1368 |
| 4363 | 1308 |
| 4364 | 1233 |
| 4365 | 1294 |
| 4366 | 1327 |
| 4367 | 1338 |
| 4368 | 1331 |
| 4369 | 1314 |
| 4370 | 1288 |
| 4371 | 1296 |
| 4372 | 1309 |
| 4373 | 1315 |
| 4374 | 1329 |
| 4375 | 1327 |
| 4376 | 1350 |
| 4377 | 1364 |
| 4378 | 1369 |
| 4379 | 1360 |
| 4380 | 1382 |
| 4381 | 1418 |
| 4382 | 1444 |
| 4383 | 1484 |
| 4384 | 1535 |
| 4385 | 1593 |
| 4386 | 1646 |
| 4387 | 1718 |
| 4388 | 1800 |
| 4389 | 1893 |
| 4390 | 1990 |
| 4391 | 2122 |
| 4392 | 2225 |
| 4393 | 2303 |
| 4394 | 2327 |
| 4395 | 2324 |
| 4396 | 2289 |
| 4397 | 2254 |
| 4398 | 2219 |
| 4399 | 2176 |
| 4400 | 2114 |
| 4401 | 2031 |
| 4402 | 1966 |
| 4403 | 1893 |
| 4404 | 1881 |
| 4405 | 1828 |
| 4406 | 1834 |
| 4407 | 1811 |
| 4408 | 1731 |
| 4409 | 1642 |
| 4410 | 1560 |
| 4411 | 1477 |
| 4412 | 1384 |
| 4413 | 1302 |
| 4414 | 1234 |
| 4415 | 1174 |
| 4416 | 1211 |
| 4417 | 1225 |
| 4418 | 1191 |
| 4419 | 1161 |
| 4420 | 1132 |
| 4421 | 1106 |
| 4422 | 1080 |
| 4423 | 1061 |
| 4424 | 1047 |
| 4425 | 1031 |
| 4426 | 1025 |
| 4427 | 1021 |
| 4428 | 1018 |
| 4429 | 1012 |
| 4430 | 1014 |
| 4431 | 1019 |
| 4432 | 1040 |
| 4433 | 1051 |
| 4434 | 1072 |
| 4435 | 1100 |
| 4436 | 1144 |
| 4437 | 1158 |
| 4438 | 1202 |
| 4439 | 1240 |
| 4440 | 1368 |
| 4441 | 1456 |
| 4442 | 1537 |
| 4443 | 1607 |
| 4444 | 1689 |
| 4445 | 1710 |
| 4446 | 1707 |
| 4447 | 1729 |
| 4448 | 1760 |
| 4449 | 1754 |
| 4450 | 1735 |
| 4451 | 1705 |
| 4452 | 1676 |
| 4453 | 1654 |
| 4454 | 1654 |
| 4455 | 1645 |
| 4456 | 1635 |
| 4457 | 1618 |
| 4458 | 1574 |
| 4459 | 1512 |
| 4460 | 1460 |
| 4461 | 1432 |
| 4462 | 1427 |
| 4463 | 1509 |
| 4464 | 1536 |
| 4465 | 1512 |
| 4466 | 1449 |
| 4467 | 1402 |
| 4468 | 1359 |
| 4469 | 1394 |
| 4470 | 1435 |
| 4471 | 1509 |
| 4472 | 1507 |
| 4473 | 1518 |
| 4474 | 1514 |
| 4475 | 1514 |
| 4476 | 1539 |
| 4477 | 1575 |
| 4478 | 1610 |
| 4479 | 1640 |
| 4480 | 1686 |
| 4481 | 1717 |
| 4482 | 1734 |
| 4483 | 1781 |
| 4484 | 1845 |
| 4485 | 1929 |
| 4486 | 2016 |
| 4487 | 2129 |
| 4488 | 2227 |
| 4489 | 2293 |
| 4490 | 2305 |
| 4491 | 2310 |
| 4492 | 2278 |
| 4493 | 2233 |
| 4494 | 2195 |
| 4495 | 2160 |
| 4496 | 2096 |
| 4497 | 2021 |
| 4498 | 1957 |
| 4499 | 1894 |
| 4500 | 1879 |
| 4501 | 1835 |
| 4502 | 1848 |
| 4503 | 1817 |
| 4504 | 1719 |
| 4505 | 1646 |
| 4506 | 1564 |
| 4507 | 1475 |
| 4508 | 1380 |
| 4509 | 1299 |
| 4510 | 1233 |
| 4511 | 1176 |
| 4512 | 1213 |
| 4513 | 1223 |
| 4514 | 1184 |
| 4515 | 1151 |
| 4516 | 1125 |
| 4517 | 1090 |
| 4518 | 1064 |
| 4519 | 1039 |
| 4520 | 1019 |
| 4521 | 1000 |
| 4522 | 987 |
| 4523 | 983 |
| 4524 | 978 |
| 4525 | 969 |
| 4526 | 969 |
| 4527 | 979 |
| 4528 | 1005 |
| 4529 | 1014 |
| 4530 | 1032 |
| 4531 | 1057 |
| 4532 | 1097 |
| 4533 | 1114 |
| 4534 | 1158 |
| 4535 | 1204 |
| 4536 | 1334 |
| 4537 | 1430 |
| 4538 | 1517 |
| 4539 | 1590 |
| 4540 | 1679 |
| 4541 | 1709 |
| 4542 | 1713 |
| 4543 | 1745 |
| 4544 | 1784 |
| 4545 | 1784 |
| 4546 | 1768 |
| 4547 | 1747 |
| 4548 | 1702 |
| 4549 | 1703 |
| 4550 | 1715 |
| 4551 | 1722 |
| 4552 | 1717 |
| 4553 | 1688 |
| 4554 | 1704 |
| 4555 | 1628 |
| 4556 | 1550 |
| 4557 | 1571 |
| 4558 | 1667 |
| 4559 | 1671 |
| 4560 | 1636 |
| 4561 | 1624 |
| 4562 | 1611 |
| 4563 | 1594 |
| 4564 | 1637 |
| 4565 | 1722 |
| 4566 | 1781 |
| 4567 | 1766 |
| 4568 | 1765 |
| 4569 | 1771 |
| 4570 | 1761 |
| 4571 | 1716 |
| 4572 | 1649 |
| 4573 | 1575 |
| 4574 | 1575 |
| 4575 | 1588 |
| 4576 | 1642 |
| 4577 | 1683 |
| 4578 | 1703 |
| 4579 | 1756 |
| 4580 | 1829 |
| 4581 | 1917 |
| 4582 | 2008 |
| 4583 | 2113 |
| 4584 | 2229 |
| 4585 | 2310 |
| 4586 | 2329 |
| 4587 | 2329 |
| 4588 | 2295 |
| 4589 | 2244 |
| 4590 | 2204 |
| 4591 | 2168 |
| 4592 | 2110 |
| 4593 | 2035 |
| 4594 | 1961 |
| 4595 | 1896 |
| 4596 | 1877 |
| 4597 | 1837 |
| 4598 | 1857 |
| 4599 | 1830 |
| 4600 | 1740 |
| 4601 | 1668 |
| 4602 | 1581 |
| 4603 | 1495 |
| 4604 | 1402 |
| 4605 | 1315 |
| 4606 | 1239 |
| 4607 | 1173 |
| 4608 | 1202 |
| 4609 | 1208 |
| 4610 | 1163 |
| 4611 | 1129 |
| 4612 | 1102 |
| 4613 | 1075 |
| 4614 | 1054 |
| 4615 | 1031 |
| 4616 | 1008 |
| 4617 | 990 |
| 4618 | 980 |
| 4619 | 977 |
| 4620 | 979 |
| 4621 | 970 |
| 4622 | 974 |
| 4623 | 974 |
| 4624 | 996 |
| 4625 | 1007 |
| 4626 | 1026 |
| 4627 | 1044 |
| 4628 | 1090 |
| 4629 | 1103 |
| 4630 | 1145 |
| 4631 | 1192 |
| 4632 | 1332 |
| 4633 | 1423 |
| 4634 | 1513 |
| 4635 | 1586 |
| 4636 | 1666 |
| 4637 | 1682 |
| 4638 | 1695 |
| 4639 | 1722 |
| 4640 | 1750 |
| 4641 | 1741 |
| 4642 | 1719 |
| 4643 | 1684 |
| 4644 | 1675 |
| 4645 | 1718 |
| 4646 | 1739 |
| 4647 | 1732 |
| 4648 | 1734 |
| 4649 | 1721 |
| 4650 | 1712 |
| 4651 | 1705 |
| 4652 | 1685 |
| 4653 | 1715 |
| 4654 | 1726 |
| 4655 | 1724 |
| 4656 | 1690 |
| 4657 | 1628 |
| 4658 | 1596 |
| 4659 | 1576 |
| 4660 | 1598 |
| 4661 | 1591 |
| 4662 | 1639 |
| 4663 | 1590 |
| 4664 | 1558 |
| 4665 | 1559 |
| 4666 | 1571 |
| 4667 | 1596 |
| 4668 | 1617 |
| 4669 | 1644 |
| 4670 | 1689 |
| 4671 | 1703 |
| 4672 | 1733 |
| 4673 | 1743 |
| 4674 | 1752 |
| 4675 | 1792 |
| 4676 | 1840 |
| 4677 | 1905 |
| 4678 | 1988 |
| 4679 | 2089 |
| 4680 | 2149 |
| 4681 | 2226 |
| 4682 | 2269 |
| 4683 | 2271 |
| 4684 | 2242 |
| 4685 | 2190 |
| 4686 | 2148 |
| 4687 | 2112 |
| 4688 | 2045 |
| 4689 | 1974 |
| 4690 | 1905 |
| 4691 | 1845 |
| 4692 | 1834 |
| 4693 | 1793 |
| 4694 | 1804 |
| 4695 | 1774 |
| 4696 | 1693 |
| 4697 | 1612 |
| 4698 | 1530 |
| 4699 | 1449 |
| 4700 | 1359 |
| 4701 | 1287 |
| 4702 | 1218 |
| 4703 | 1158 |
| 4704 | 1202 |
| 4705 | 1217 |
| 4706 | 1170 |
| 4707 | 1134 |
| 4708 | 1104 |
| 4709 | 1066 |
| 4710 | 1025 |
| 4711 | 999 |
| 4712 | 986 |
| 4713 | 976 |
| 4714 | 965 |
| 4715 | 954 |
| 4716 | 957 |
| 4717 | 956 |
| 4718 | 954 |
| 4719 | 954 |
| 4720 | 979 |
| 4721 | 990 |
| 4722 | 1006 |
| 4723 | 1031 |
| 4724 | 1071 |
| 4725 | 1084 |
| 4726 | 1128 |
| 4727 | 1169 |
| 4728 | 1293 |
| 4729 | 1395 |
| 4730 | 1477 |
| 4731 | 1555 |
| 4732 | 1632 |
| 4733 | 1647 |
| 4734 | 1673 |
| 4735 | 1703 |
| 4736 | 1744 |
| 4737 | 1739 |
| 4738 | 1716 |
| 4739 | 1669 |
| 4740 | 1599 |
| 4741 | 1583 |
| 4742 | 1632 |
| 4743 | 1641 |
| 4744 | 1640 |
| 4745 | 1623 |
| 4746 | 1593 |
| 4747 | 1623 |
| 4748 | 1670 |
| 4749 | 1725 |
| 4750 | 1685 |
| 4751 | 1705 |
| 4752 | 1662 |
| 4753 | 1625 |
| 4754 | 1588 |
| 4755 | 1597 |
| 4756 | 1539 |
| 4757 | 1535 |
| 4758 | 1584 |
| 4759 | 1567 |
| 4760 | 1547 |
| 4761 | 1561 |
| 4762 | 1539 |
| 4763 | 1501 |
| 4764 | 1506 |
| 4765 | 1573 |
| 4766 | 1605 |
| 4767 | 1587 |
| 4768 | 1591 |
| 4769 | 1610 |
| 4770 | 1657 |
| 4771 | 1705 |
| 4772 | 1787 |
| 4773 | 1856 |
| 4774 | 1931 |
| 4775 | 2036 |
| 4776 | 2129 |
| 4777 | 2221 |
| 4778 | 2254 |
| 4779 | 2255 |
| 4780 | 2235 |
| 4781 | 2195 |
| 4782 | 2153 |
| 4783 | 2111 |
| 4784 | 2042 |
| 4785 | 1972 |
| 4786 | 1895 |
| 4787 | 1840 |
| 4788 | 1836 |
| 4789 | 1800 |
| 4790 | 1815 |
| 4791 | 1792 |
| 4792 | 1721 |
| 4793 | 1663 |
| 4794 | 1607 |
| 4795 | 1533 |
| 4796 | 1449 |
| 4797 | 1377 |
| 4798 | 1309 |
| 4799 | 1247 |
| 4800 | 1275 |
| 4801 | 1284 |
| 4802 | 1235 |
| 4803 | 1201 |
| 4804 | 1162 |
| 4805 | 1122 |
| 4806 | 1085 |
| 4807 | 1061 |
| 4808 | 1041 |
| 4809 | 1019 |
| 4810 | 999 |
| 4811 | 989 |
| 4812 | 997 |
| 4813 | 989 |
| 4814 | 988 |
| 4815 | 982 |
| 4816 | 989 |
| 4817 | 990 |
| 4818 | 989 |
| 4819 | 998 |
| 4820 | 1010 |
| 4821 | 1001 |
| 4822 | 1009 |
| 4823 | 992 |
| 4824 | 1058 |
| 4825 | 1100 |
| 4826 | 1145 |
| 4827 | 1175 |
| 4828 | 1219 |
| 4829 | 1270 |
| 4830 | 1320 |
| 4831 | 1366 |
| 4832 | 1409 |
| 4833 | 1443 |
| 4834 | 1480 |
| 4835 | 1508 |
| 4836 | 1548 |
| 4837 | 1549 |
| 4838 | 1557 |
| 4839 | 1531 |
| 4840 | 1548 |
| 4841 | 1532 |
| 4842 | 1538 |
| 4843 | 1567 |
| 4844 | 1563 |
| 4845 | 1560 |
| 4846 | 1607 |
| 4847 | 1699 |
| 4848 | 1766 |
| 4849 | 1756 |
| 4850 | 1757 |
| 4851 | 1667 |
| 4852 | 1580 |
| 4853 | 1545 |
| 4854 | 1636 |
| 4855 | 1641 |
| 4856 | 1640 |
| 4857 | 1625 |
| 4858 | 1616 |
| 4859 | 1610 |
| 4860 | 1617 |
| 4861 | 1635 |
| 4862 | 1643 |
| 4863 | 1645 |
| 4864 | 1661 |
| 4865 | 1690 |
| 4866 | 1706 |
| 4867 | 1761 |
| 4868 | 1825 |
| 4869 | 1885 |
| 4870 | 1976 |
| 4871 | 2054 |
| 4872 | 2111 |
| 4873 | 2185 |
| 4874 | 2197 |
| 4875 | 2166 |
| 4876 | 2125 |
| 4877 | 2078 |
| 4878 | 2029 |
| 4879 | 1987 |
| 4880 | 1949 |
| 4881 | 1867 |
| 4882 | 1787 |
| 4883 | 1738 |
| 4884 | 1730 |
| 4885 | 1692 |
| 4886 | 1718 |
| 4887 | 1699 |
| 4888 | 1642 |
| 4889 | 1598 |
| 4890 | 1551 |
| 4891 | 1491 |
| 4892 | 1422 |
| 4893 | 1360 |
| 4894 | 1296 |
| 4895 | 1241 |
| 4896 | 1275 |
| 4897 | 1279 |
| 4898 | 1239 |
| 4899 | 1200 |
| 4900 | 1159 |
| 4901 | 1112 |
| 4902 | 1074 |
| 4903 | 1045 |
| 4904 | 1023 |
| 4905 | 1006 |
| 4906 | 985 |
| 4907 | 971 |
| 4908 | 966 |
| 4909 | 954 |
| 4910 | 943 |
| 4911 | 944 |
| 4912 | 945 |
| 4913 | 940 |
| 4914 | 940 |
| 4915 | 937 |
| 4916 | 942 |
| 4917 | 929 |
| 4918 | 925 |
| 4919 | 898 |
| 4920 | 933 |
| 4921 | 941 |
| 4922 | 967 |
| 4923 | 999 |
| 4924 | 1021 |
| 4925 | 1045 |
| 4926 | 1079 |
| 4927 | 1134 |
| 4928 | 1195 |
| 4929 | 1252 |
| 4930 | 1293 |
| 4931 | 1331 |
| 4932 | 1356 |
| 4933 | 1361 |
| 4934 | 1376 |
| 4935 | 1384 |
| 4936 | 1413 |
| 4937 | 1426 |
| 4938 | 1446 |
| 4939 | 1449 |
| 4940 | 1429 |
| 4941 | 1462 |
| 4942 | 1466 |
| 4943 | 1498 |
| 4944 | 1422 |
| 4945 | 1336 |
| 4946 | 1342 |
| 4947 | 1316 |
| 4948 | 1214 |
| 4949 | 1134 |
| 4950 | 1119 |
| 4951 | 1158 |
| 4952 | 1160 |
| 4953 | 1102 |
| 4954 | 1140 |
| 4955 | 1114 |
| 4956 | 1165 |
| 4957 | 1165 |
| 4958 | 1129 |
| 4959 | 1161 |
| 4960 | 1221 |
| 4961 | 1268 |
| 4962 | 1297 |
| 4963 | 1359 |
| 4964 | 1450 |
| 4965 | 1548 |
| 4966 | 1643 |
| 4967 | 1750 |
| 4968 | 1872 |
| 4969 | 1987 |
| 4970 | 2039 |
| 4971 | 2042 |
| 4972 | 2028 |
| 4973 | 2000 |
| 4974 | 1975 |
| 4975 | 1940 |
| 4976 | 1907 |
| 4977 | 1839 |
| 4978 | 1768 |
| 4979 | 1713 |
| 4980 | 1702 |
| 4981 | 1676 |
| 4982 | 1702 |
| 4983 | 1706 |
| 4984 | 1635 |
| 4985 | 1562 |
| 4986 | 1490 |
| 4987 | 1425 |
| 4988 | 1343 |
| 4989 | 1265 |
| 4990 | 1203 |
| 4991 | 1150 |
| 4992 | 1184 |
| 4993 | 1197 |
| 4994 | 1156 |
| 4995 | 1125 |
| 4996 | 1100 |
| 4997 | 1072 |
| 4998 | 1048 |
| 4999 | 1032 |
| 5000 | 1018 |
| 5001 | 1003 |
| 5002 | 990 |
| 5003 | 981 |
| 5004 | 980 |
| 5005 | 970 |
| 5006 | 966 |
| 5007 | 969 |
| 5008 | 993 |
| 5009 | 1005 |
| 5010 | 1017 |
| 5011 | 1044 |
| 5012 | 1091 |
| 5013 | 1109 |
| 5014 | 1149 |
| 5015 | 1185 |
| 5016 | 1311 |
| 5017 | 1398 |
| 5018 | 1478 |
| 5019 | 1540 |
| 5020 | 1596 |
| 5021 | 1603 |
| 5022 | 1623 |
| 5023 | 1640 |
| 5024 | 1659 |
| 5025 | 1637 |
| 5026 | 1601 |
| 5027 | 1562 |
| 5028 | 1495 |
| 5029 | 1467 |
| 5030 | 1454 |
| 5031 | 1408 |
| 5032 | 1393 |
| 5033 | 1380 |
| 5034 | 1370 |
| 5035 | 1357 |
| 5036 | 1348 |
| 5037 | 1385 |
| 5038 | 1369 |
| 5039 | 1314 |
| 5040 | 1262 |
| 5041 | 1191 |
| 5042 | 1195 |
| 5043 | 1244 |
| 5044 | 1251 |
| 5045 | 1262 |
| 5046 | 1288 |
| 5047 | 1295 |
| 5048 | 1330 |
| 5049 | 1349 |
| 5050 | 1351 |
| 5051 | 1351 |
| 5052 | 1362 |
| 5053 | 1393 |
| 5054 | 1410 |
| 5055 | 1430 |
| 5056 | 1470 |
| 5057 | 1528 |
| 5058 | 1574 |
| 5059 | 1625 |
| 5060 | 1708 |
| 5061 | 1791 |
| 5062 | 1888 |
| 5063 | 2004 |
| 5064 | 2119 |
| 5065 | 2224 |
| 5066 | 2278 |
| 5067 | 2293 |
| 5068 | 2261 |
| 5069 | 2226 |
| 5070 | 2198 |
| 5071 | 2150 |
| 5072 | 2092 |
| 5073 | 2017 |
| 5074 | 1944 |
| 5075 | 1875 |
| 5076 | 1866 |
| 5077 | 1815 |
| 5078 | 1823 |
| 5079 | 1800 |
| 5080 | 1709 |
| 5081 | 1623 |
| 5082 | 1548 |
| 5083 | 1470 |
| 5084 | 1390 |
| 5085 | 1314 |
| 5086 | 1250 |
| 5087 | 1194 |
| 5088 | 1232 |
| 5089 | 1243 |
| 5090 | 1208 |
| 5091 | 1175 |
| 5092 | 1146 |
| 5093 | 1121 |
| 5094 | 1101 |
| 5095 | 1081 |
| 5096 | 1065 |
| 5097 | 1050 |
| 5098 | 1040 |
| 5099 | 1033 |
| 5100 | 1033 |
| 5101 | 1033 |
| 5102 | 1035 |
| 5103 | 1038 |
| 5104 | 1059 |
| 5105 | 1067 |
| 5106 | 1083 |
| 5107 | 1110 |
| 5108 | 1153 |
| 5109 | 1164 |
| 5110 | 1206 |
| 5111 | 1238 |
| 5112 | 1368 |
| 5113 | 1457 |
| 5114 | 1533 |
| 5115 | 1576 |
| 5116 | 1647 |
| 5117 | 1661 |
| 5118 | 1662 |
| 5119 | 1681 |
| 5120 | 1700 |
| 5121 | 1691 |
| 5122 | 1659 |
| 5123 | 1629 |
| 5124 | 1582 |
| 5125 | 1538 |
| 5126 | 1512 |
| 5127 | 1472 |
| 5128 | 1443 |
| 5129 | 1407 |
| 5130 | 1347 |
| 5131 | 1273 |
| 5132 | 1213 |
| 5133 | 1196 |
| 5134 | 1205 |
| 5135 | 1262 |
| 5136 | 1261 |
| 5137 | 1232 |
| 5138 | 1168 |
| 5139 | 1107 |
| 5140 | 1078 |
| 5141 | 1128 |
| 5142 | 1202 |
| 5143 | 1261 |
| 5144 | 1266 |
| 5145 | 1286 |
| 5146 | 1304 |
| 5147 | 1328 |
| 5148 | 1361 |
| 5149 | 1372 |
| 5150 | 1404 |
| 5151 | 1452 |
| 5152 | 1540 |
| 5153 | 1596 |
| 5154 | 1643 |
| 5155 | 1693 |
| 5156 | 1752 |
| 5157 | 1834 |
| 5158 | 1918 |
| 5159 | 2017 |
| 5160 | 2117 |
| 5161 | 2210 |
| 5162 | 2271 |
| 5163 | 2290 |
| 5164 | 2265 |
| 5165 | 2220 |
| 5166 | 2183 |
| 5167 | 2142 |
| 5168 | 2082 |
| 5169 | 2006 |
| 5170 | 1935 |
| 5171 | 1872 |
| 5172 | 1855 |
| 5173 | 1814 |
| 5174 | 1822 |
| 5175 | 1786 |
| 5176 | 1695 |
| 5177 | 1621 |
| 5178 | 1538 |
| 5179 | 1454 |
| 5180 | 1365 |
| 5181 | 1289 |
| 5182 | 1221 |
| 5183 | 1167 |
| 5184 | 1198 |
| 5185 | 1204 |
| 5186 | 1169 |
| 5187 | 1141 |
| 5188 | 1111 |
| 5189 | 1078 |
| 5190 | 1051 |
| 5191 | 1032 |
| 5192 | 1015 |
| 5193 | 995 |
| 5194 | 982 |
| 5195 | 978 |
| 5196 | 979 |
| 5197 | 978 |
| 5198 | 983 |
| 5199 | 991 |
| 5200 | 1019 |
| 5201 | 1024 |
| 5202 | 1040 |
| 5203 | 1063 |
| 5204 | 1105 |
| 5205 | 1122 |
| 5206 | 1163 |
| 5207 | 1209 |
| 5208 | 1336 |
| 5209 | 1429 |
| 5210 | 1514 |
| 5211 | 1565 |
| 5212 | 1639 |
| 5213 | 1664 |
| 5214 | 1679 |
| 5215 | 1706 |
| 5216 | 1737 |
| 5217 | 1734 |
| 5218 | 1713 |
| 5219 | 1704 |
| 5220 | 1680 |
| 5221 | 1674 |
| 5222 | 1673 |
| 5223 | 1696 |
| 5224 | 1691 |
| 5225 | 1649 |
| 5226 | 1579 |
| 5227 | 1516 |
| 5228 | 1450 |
| 5229 | 1454 |
| 5230 | 1521 |
| 5231 | 1504 |
| 5232 | 1437 |
| 5233 | 1410 |
| 5234 | 1393 |
| 5235 | 1394 |
| 5236 | 1430 |
| 5237 | 1526 |
| 5238 | 1591 |
| 5239 | 1582 |
| 5240 | 1586 |
| 5241 | 1585 |
| 5242 | 1599 |
| 5243 | 1568 |
| 5244 | 1554 |
| 5245 | 1520 |
| 5246 | 1524 |
| 5247 | 1540 |
| 5248 | 1575 |
| 5249 | 1610 |
| 5250 | 1629 |
| 5251 | 1679 |
| 5252 | 1759 |
| 5253 | 1842 |
| 5254 | 1935 |
| 5255 | 2032 |
| 5256 | 2129 |
| 5257 | 2227 |
| 5258 | 2287 |
| 5259 | 2314 |
| 5260 | 2288 |
| 5261 | 2234 |
| 5262 | 2196 |
| 5263 | 2151 |
| 5264 | 2096 |
| 5265 | 2028 |
| 5266 | 1953 |
| 5267 | 1888 |
| 5268 | 1872 |
| 5269 | 1831 |
| 5270 | 1857 |
| 5271 | 1824 |
| 5272 | 1733 |
| 5273 | 1662 |
| 5274 | 1581 |
| 5275 | 1496 |
| 5276 | 1404 |
| 5277 | 1320 |
| 5278 | 1244 |
| 5279 | 1182 |
| 5280 | 1212 |
| 5281 | 1218 |
| 5282 | 1179 |
| 5283 | 1153 |
| 5284 | 1121 |
| 5285 | 1096 |
| 5286 | 1069 |
| 5287 | 1044 |
| 5288 | 1028 |
| 5289 | 1011 |
| 5290 | 1000 |
| 5291 | 992 |
| 5292 | 995 |
| 5293 | 989 |
| 5294 | 991 |
| 5295 | 994 |
| 5296 | 1021 |
| 5297 | 1030 |
| 5298 | 1048 |
| 5299 | 1073 |
| 5300 | 1120 |
| 5301 | 1133 |
| 5302 | 1175 |
| 5303 | 1216 |
| 5304 | 1351 |
| 5305 | 1450 |
| 5306 | 1531 |
| 5307 | 1581 |
| 5308 | 1653 |
| 5309 | 1675 |
| 5310 | 1697 |
| 5311 | 1722 |
| 5312 | 1753 |
| 5313 | 1753 |
| 5314 | 1754 |
| 5315 | 1734 |
| 5316 | 1704 |
| 5317 | 1692 |
| 5318 | 1684 |
| 5319 | 1677 |
| 5320 | 1670 |
| 5321 | 1636 |
| 5322 | 1575 |
| 5323 | 1518 |
| 5324 | 1452 |
| 5325 | 1448 |
| 5326 | 1441 |
| 5327 | 1428 |
| 5328 | 1387 |
| 5329 | 1312 |
| 5330 | 1279 |
| 5331 | 1250 |
| 5332 | 1264 |
| 5333 | 1253 |
| 5334 | 1305 |
| 5335 | 1265 |
| 5336 | 1235 |
| 5337 | 1246 |
| 5338 | 1271 |
| 5339 | 1303 |
| 5340 | 1343 |
| 5341 | 1388 |
| 5342 | 1440 |
| 5343 | 1470 |
| 5344 | 1513 |
| 5345 | 1547 |
| 5346 | 1575 |
| 5347 | 1629 |
| 5348 | 1692 |
| 5349 | 1780 |
| 5350 | 1872 |
| 5351 | 1970 |
| 5352 | 2052 |
| 5353 | 2149 |
| 5354 | 2239 |
| 5355 | 2279 |
| 5356 | 2253 |
| 5357 | 2210 |
| 5358 | 2179 |
| 5359 | 2144 |
| 5360 | 2077 |
| 5361 | 2001 |
| 5362 | 1929 |
| 5363 | 1872 |
| 5364 | 1846 |
| 5365 | 1802 |
| 5366 | 1813 |
| 5367 | 1779 |
| 5368 | 1699 |
| 5369 | 1622 |
| 5370 | 1543 |
| 5371 | 1464 |
| 5372 | 1374 |
| 5373 | 1301 |
| 5374 | 1233 |
| 5375 | 1170 |
| 5376 | 1207 |
| 5377 | 1217 |
| 5378 | 1172 |
| 5379 | 1139 |
| 5380 | 1112 |
| 5381 | 1083 |
| 5382 | 1049 |
| 5383 | 1025 |
| 5384 | 1010 |
| 5385 | 997 |
| 5386 | 987 |
| 5387 | 977 |
| 5388 | 976 |
| 5389 | 974 |
| 5390 | 972 |
| 5391 | 977 |
| 5392 | 1001 |
| 5393 | 1011 |
| 5394 | 1030 |
| 5395 | 1060 |
| 5396 | 1093 |
| 5397 | 1106 |
| 5398 | 1150 |
| 5399 | 1192 |
| 5400 | 1316 |
| 5401 | 1416 |
| 5402 | 1491 |
| 5403 | 1546 |
| 5404 | 1608 |
| 5405 | 1631 |
| 5406 | 1648 |
| 5407 | 1672 |
| 5408 | 1698 |
| 5409 | 1678 |
| 5410 | 1654 |
| 5411 | 1604 |
| 5412 | 1545 |
| 5413 | 1532 |
| 5414 | 1569 |
| 5415 | 1561 |
| 5416 | 1513 |
| 5417 | 1480 |
| 5418 | 1431 |
| 5419 | 1433 |
| 5420 | 1477 |
| 5421 | 1522 |
| 5422 | 1539 |
| 5423 | 1545 |
| 5424 | 1491 |
| 5425 | 1452 |
| 5426 | 1397 |
| 5427 | 1396 |
| 5428 | 1353 |
| 5429 | 1334 |
| 5430 | 1374 |
| 5431 | 1365 |
| 5432 | 1332 |
| 5433 | 1333 |
| 5434 | 1311 |
| 5435 | 1272 |
| 5436 | 1286 |
| 5437 | 1351 |
| 5438 | 1395 |
| 5439 | 1388 |
| 5440 | 1410 |
| 5441 | 1453 |
| 5442 | 1530 |
| 5443 | 1600 |
| 5444 | 1692 |
| 5445 | 1763 |
| 5446 | 1839 |
| 5447 | 1938 |
| 5448 | 2032 |
| 5449 | 2153 |
| 5450 | 2236 |
| 5451 | 2254 |
| 5452 | 2242 |
| 5453 | 2199 |
| 5454 | 2156 |
| 5455 | 2119 |
| 5456 | 2041 |
| 5457 | 1969 |
| 5458 | 1890 |
| 5459 | 1836 |
| 5460 | 1832 |
| 5461 | 1798 |
| 5462 | 1809 |
| 5463 | 1780 |
| 5464 | 1710 |
| 5465 | 1651 |
| 5466 | 1596 |
| 5467 | 1519 |
| 5468 | 1441 |
| 5469 | 1370 |
| 5470 | 1310 |
| 5471 | 1249 |
| 5472 | 1271 |
| 5473 | 1280 |
| 5474 | 1231 |
| 5475 | 1195 |
| 5476 | 1160 |
| 5477 | 1125 |
| 5478 | 1092 |
| 5479 | 1067 |
| 5480 | 1052 |
| 5481 | 1034 |
| 5482 | 1016 |
| 5483 | 1001 |
| 5484 | 1007 |
| 5485 | 999 |
| 5486 | 999 |
| 5487 | 999 |
| 5488 | 1005 |
| 5489 | 1006 |
| 5490 | 1010 |
| 5491 | 1020 |
| 5492 | 1035 |
| 5493 | 1030 |
| 5494 | 1035 |
| 5495 | 1015 |
| 5496 | 1075 |
| 5497 | 1117 |
| 5498 | 1162 |
| 5499 | 1185 |
| 5500 | 1231 |
| 5501 | 1268 |
| 5502 | 1313 |
| 5503 | 1350 |
| 5504 | 1367 |
| 5505 | 1377 |
| 5506 | 1380 |
| 5507 | 1388 |
| 5508 | 1395 |
| 5509 | 1369 |
| 5510 | 1362 |
| 5511 | 1320 |
| 5512 | 1318 |
| 5513 | 1286 |
| 5514 | 1270 |
| 5515 | 1286 |
| 5516 | 1275 |
| 5517 | 1267 |
| 5518 | 1309 |
| 5519 | 1397 |
| 5520 | 1439 |
| 5521 | 1432 |
| 5522 | 1418 |
| 5523 | 1350 |
| 5524 | 1272 |
| 5525 | 1235 |
| 5526 | 1311 |
| 5527 | 1311 |
| 5528 | 1312 |
| 5529 | 1320 |
| 5530 | 1319 |
| 5531 | 1323 |
| 5532 | 1343 |
| 5533 | 1366 |
| 5534 | 1384 |
| 5535 | 1397 |
| 5536 | 1428 |
| 5537 | 1475 |
| 5538 | 1513 |
| 5539 | 1586 |
| 5540 | 1668 |
| 5541 | 1741 |
| 5542 | 1833 |
| 5543 | 1915 |
| 5544 | 1982 |
| 5545 | 2082 |
| 5546 | 2132 |
| 5547 | 2137 |
| 5548 | 2117 |
| 5549 | 2071 |
| 5550 | 2028 |
| 5551 | 1978 |
| 5552 | 1936 |
| 5553 | 1856 |
| 5554 | 1774 |
| 5555 | 1730 |
| 5556 | 1728 |
| 5557 | 1694 |
| 5558 | 1716 |
| 5559 | 1706 |
| 5560 | 1646 |
| 5561 | 1595 |
| 5562 | 1543 |
| 5563 | 1485 |
| 5564 | 1414 |
| 5565 | 1357 |
| 5566 | 1291 |
| 5567 | 1237 |
| 5568 | 1262 |
| 5569 | 1265 |
| 5570 | 1218 |
| 5571 | 1180 |
| 5572 | 1145 |
| 5573 | 1102 |
| 5574 | 1072 |
| 5575 | 1042 |
| 5576 | 1019 |
| 5577 | 1002 |
| 5578 | 985 |
| 5579 | 973 |
| 5580 | 969 |
| 5581 | 960 |
| 5582 | 952 |
| 5583 | 954 |
| 5584 | 959 |
| 5585 | 950 |
| 5586 | 950 |
| 5587 | 950 |
| 5588 | 957 |
| 5589 | 945 |
| 5590 | 945 |
| 5591 | 920 |
| 5592 | 955 |
| 5593 | 965 |
| 5594 | 978 |
| 5595 | 1000 |
| 5596 | 1013 |
| 5597 | 1033 |
| 5598 | 1069 |
| 5599 | 1107 |
| 5600 | 1143 |
| 5601 | 1177 |
| 5602 | 1190 |
| 5603 | 1201 |
| 5604 | 1221 |
| 5605 | 1217 |
| 5606 | 1216 |
| 5607 | 1225 |
| 5608 | 1235 |
| 5609 | 1237 |
| 5610 | 1236 |
| 5611 | 1208 |
| 5612 | 1189 |
| 5613 | 1211 |
| 5614 | 1218 |
| 5615 | 1230 |
| 5616 | 1185 |
| 5617 | 1113 |
| 5618 | 1074 |
| 5619 | 1021 |
| 5620 | 949 |
| 5621 | 913 |
| 5622 | 925 |
| 5623 | 913 |
| 5624 | 878 |
| 5625 | 845 |
| 5626 | 841 |
| 5627 | 853 |
| 5628 | 880 |
| 5629 | 915 |
| 5630 | 944 |
| 5631 | 994 |
| 5632 | 1049 |
| 5633 | 1107 |
| 5634 | 1150 |
| 5635 | 1216 |
| 5636 | 1315 |
| 5637 | 1427 |
| 5638 | 1532 |
| 5639 | 1637 |
| 5640 | 1746 |
| 5641 | 1862 |
| 5642 | 1946 |
| 5643 | 1983 |
| 5644 | 1994 |
| 5645 | 1971 |
| 5646 | 1946 |
| 5647 | 1917 |
| 5648 | 1878 |
| 5649 | 1807 |
| 5650 | 1738 |
| 5651 | 1684 |
| 5652 | 1679 |
| 5653 | 1647 |
| 5654 | 1670 |
| 5655 | 1666 |
| 5656 | 1593 |
| 5657 | 1520 |
| 5658 | 1451 |
| 5659 | 1387 |
| 5660 | 1307 |
| 5661 | 1232 |
| 5662 | 1165 |
| 5663 | 1111 |
| 5664 | 1140 |
| 5665 | 1151 |
| 5666 | 1112 |
| 5667 | 1081 |
| 5668 | 1054 |
| 5669 | 1027 |
| 5670 | 1007 |
| 5671 | 990 |
| 5672 | 976 |
| 5673 | 959 |
| 5674 | 946 |
| 5675 | 938 |
| 5676 | 938 |
| 5677 | 931 |
| 5678 | 927 |
| 5679 | 934 |
| 5680 | 956 |
| 5681 | 971 |
| 5682 | 987 |
| 5683 | 1016 |
| 5684 | 1061 |
| 5685 | 1080 |
| 5686 | 1123 |
| 5687 | 1169 |
| 5688 | 1296 |
| 5689 | 1385 |
| 5690 | 1440 |
| 5691 | 1484 |
| 5692 | 1536 |
| 5693 | 1553 |
| 5694 | 1569 |
| 5695 | 1587 |
| 5696 | 1606 |
| 5697 | 1574 |
| 5698 | 1531 |
| 5699 | 1495 |
| 5700 | 1439 |
| 5701 | 1400 |
| 5702 | 1370 |
| 5703 | 1332 |
| 5704 | 1321 |
| 5705 | 1304 |
| 5706 | 1291 |
| 5707 | 1272 |
| 5708 | 1270 |
| 5709 | 1285 |
| 5710 | 1280 |
| 5711 | 1247 |
| 5712 | 1200 |
| 5713 | 1128 |
| 5714 | 1138 |
| 5715 | 1170 |
| 5716 | 1163 |
| 5717 | 1179 |
| 5718 | 1202 |
| 5719 | 1198 |
| 5720 | 1221 |
| 5721 | 1243 |
| 5722 | 1255 |
| 5723 | 1258 |
| 5724 | 1263 |
| 5725 | 1298 |
| 5726 | 1322 |
| 5727 | 1337 |
| 5728 | 1385 |
| 5729 | 1442 |
| 5730 | 1491 |
| 5731 | 1534 |
| 5732 | 1614 |
| 5733 | 1694 |
| 5734 | 1790 |
| 5735 | 1894 |
| 5736 | 1976 |
| 5737 | 2081 |
| 5738 | 2175 |
| 5739 | 2229 |
| 5740 | 2217 |
| 5741 | 2185 |
| 5742 | 2159 |
| 5743 | 2111 |
| 5744 | 2053 |
| 5745 | 1975 |
| 5746 | 1896 |
| 5747 | 1831 |
| 5748 | 1814 |
| 5749 | 1769 |
| 5750 | 1776 |
| 5751 | 1746 |
| 5752 | 1655 |
| 5753 | 1579 |
| 5754 | 1505 |
| 5755 | 1427 |
| 5756 | 1344 |
| 5757 | 1272 |
| 5758 | 1206 |
| 5759 | 1158 |
| 5760 | 1189 |
| 5761 | 1200 |
| 5762 | 1167 |
| 5763 | 1133 |
| 5764 | 1103 |
| 5765 | 1078 |
| 5766 | 1055 |
| 5767 | 1039 |
| 5768 | 1027 |
| 5769 | 1011 |
| 5770 | 1002 |
| 5771 | 997 |
| 5772 | 999 |
| 5773 | 1001 |
| 5774 | 1006 |
| 5775 | 1008 |
| 5776 | 1030 |
| 5777 | 1037 |
| 5778 | 1053 |
| 5779 | 1077 |
| 5780 | 1120 |
| 5781 | 1128 |
| 5782 | 1169 |
| 5783 | 1211 |
| 5784 | 1338 |
| 5785 | 1434 |
| 5786 | 1487 |
| 5787 | 1523 |
| 5788 | 1576 |
| 5789 | 1588 |
| 5790 | 1580 |
| 5791 | 1583 |
| 5792 | 1587 |
| 5793 | 1558 |
| 5794 | 1503 |
| 5795 | 1446 |
| 5796 | 1380 |
| 5797 | 1325 |
| 5798 | 1281 |
| 5799 | 1226 |
| 5800 | 1192 |
| 5801 | 1147 |
| 5802 | 1110 |
| 5803 | 1068 |
| 5804 | 1043 |
| 5805 | 1037 |
| 5806 | 1051 |
| 5807 | 1040 |
| 5808 | 1026 |
| 5809 | 1017 |
| 5810 | 976 |
| 5811 | 957 |
| 5812 | 919 |
| 5813 | 934 |
| 5814 | 979 |
| 5815 | 1002 |
| 5816 | 1013 |
| 5817 | 1053 |
| 5818 | 1092 |
| 5819 | 1147 |
| 5820 | 1183 |
| 5821 | 1191 |
| 5822 | 1235 |
| 5823 | 1282 |
| 5824 | 1358 |
| 5825 | 1423 |
| 5826 | 1478 |
| 5827 | 1528 |
| 5828 | 1600 |
| 5829 | 1689 |
| 5830 | 1778 |
| 5831 | 1872 |
| 5832 | 1956 |
| 5833 | 2056 |
| 5834 | 2145 |
| 5835 | 2212 |
| 5836 | 2201 |
| 5837 | 2167 |
| 5838 | 2133 |
| 5839 | 2089 |
| 5840 | 2037 |
| 5841 | 1966 |
| 5842 | 1887 |
| 5843 | 1824 |
| 5844 | 1799 |
| 5845 | 1754 |
| 5846 | 1756 |
| 5847 | 1718 |
| 5848 | 1629 |
| 5849 | 1544 |
| 5850 | 1463 |
| 5851 | 1386 |
| 5852 | 1299 |
| 5853 | 1224 |
| 5854 | 1158 |
| 5855 | 1107 |
| 5856 | 1133 |
| 5857 | 1139 |
| 5858 | 1106 |
| 5859 | 1079 |
| 5860 | 1049 |
| 5861 | 1023 |
| 5862 | 1000 |
| 5863 | 988 |
| 5864 | 974 |
| 5865 | 957 |
| 5866 | 948 |
| 5867 | 943 |
| 5868 | 949 |
| 5869 | 951 |
| 5870 | 955 |
| 5871 | 961 |
| 5872 | 991 |
| 5873 | 997 |
| 5874 | 1017 |
| 5875 | 1038 |
| 5876 | 1085 |
| 5877 | 1103 |
| 5878 | 1143 |
| 5879 | 1194 |
| 5880 | 1324 |
| 5881 | 1419 |
| 5882 | 1486 |
| 5883 | 1521 |
| 5884 | 1576 |
| 5885 | 1591 |
| 5886 | 1603 |
| 5887 | 1619 |
| 5888 | 1638 |
| 5889 | 1613 |
| 5890 | 1573 |
| 5891 | 1550 |
| 5892 | 1518 |
| 5893 | 1490 |
| 5894 | 1465 |
| 5895 | 1468 |
| 5896 | 1454 |
| 5897 | 1415 |
| 5898 | 1346 |
| 5899 | 1300 |
| 5900 | 1267 |
| 5901 | 1277 |
| 5902 | 1296 |
| 5903 | 1291 |
| 5904 | 1215 |
| 5905 | 1191 |
| 5906 | 1175 |
| 5907 | 1199 |
| 5908 | 1229 |
| 5909 | 1266 |
| 5910 | 1295 |
| 5911 | 1278 |
| 5912 | 1281 |
| 5913 | 1283 |
| 5914 | 1305 |
| 5915 | 1301 |
| 5916 | 1322 |
| 5917 | 1334 |
| 5918 | 1361 |
| 5919 | 1394 |
| 5920 | 1410 |
| 5921 | 1442 |
| 5922 | 1485 |
| 5923 | 1553 |
| 5924 | 1640 |
| 5925 | 1722 |
| 5926 | 1820 |
| 5927 | 1910 |
| 5928 | 1989 |
| 5929 | 2084 |
| 5930 | 2170 |
| 5931 | 2246 |
| 5932 | 2242 |
| 5933 | 2200 |
| 5934 | 2162 |
| 5935 | 2125 |
| 5936 | 2067 |
| 5937 | 1996 |
| 5938 | 1917 |
| 5939 | 1857 |
| 5940 | 1840 |
| 5941 | 1797 |
| 5942 | 1814 |
| 5943 | 1775 |
| 5944 | 1680 |
| 5945 | 1607 |
| 5946 | 1523 |
| 5947 | 1437 |
| 5948 | 1349 |
| 5949 | 1270 |
| 5950 | 1200 |
| 5951 | 1142 |
| 5952 | 1172 |
| 5953 | 1173 |
| 5954 | 1132 |
| 5955 | 1106 |
| 5956 | 1077 |
| 5957 | 1056 |
| 5958 | 1032 |
| 5959 | 1008 |
| 5960 | 996 |
| 5961 | 984 |
| 5962 | 975 |
| 5963 | 968 |
| 5964 | 972 |
| 5965 | 971 |
| 5966 | 975 |
| 5967 | 980 |
| 5968 | 1010 |
| 5969 | 1018 |
| 5970 | 1037 |
| 5971 | 1063 |
| 5972 | 1108 |
| 5973 | 1123 |
| 5974 | 1167 |
| 5975 | 1212 |
| 5976 | 1344 |
| 5977 | 1436 |
| 5978 | 1496 |
| 5979 | 1534 |
| 5980 | 1593 |
| 5981 | 1611 |
| 5982 | 1621 |
| 5983 | 1630 |
| 5984 | 1651 |
| 5985 | 1633 |
| 5986 | 1608 |
| 5987 | 1577 |
| 5988 | 1533 |
| 5989 | 1504 |
| 5990 | 1479 |
| 5991 | 1457 |
| 5992 | 1446 |
| 5993 | 1410 |
| 5994 | 1347 |
| 5995 | 1274 |
| 5996 | 1206 |
| 5997 | 1206 |
| 5998 | 1200 |
| 5999 | 1202 |
| 6000 | 1167 |
| 6001 | 1114 |
| 6002 | 1067 |
| 6003 | 1013 |
| 6004 | 1003 |
| 6005 | 1016 |
| 6006 | 1068 |
| 6007 | 1064 |
| 6008 | 1075 |
| 6009 | 1103 |
| 6010 | 1141 |
| 6011 | 1181 |
| 6012 | 1197 |
| 6013 | 1223 |
| 6014 | 1278 |
| 6015 | 1311 |
| 6016 | 1362 |
| 6017 | 1400 |
| 6018 | 1448 |
| 6019 | 1525 |
| 6020 | 1589 |
| 6021 | 1674 |
| 6022 | 1768 |
| 6023 | 1858 |
| 6024 | 1936 |
| 6025 | 2024 |
| 6026 | 2143 |
| 6027 | 2231 |
| 6028 | 2228 |
| 6029 | 2197 |
| 6030 | 2164 |
| 6031 | 2133 |
| 6032 | 2067 |
| 6033 | 1992 |
| 6034 | 1920 |
| 6035 | 1863 |
| 6036 | 1835 |
| 6037 | 1794 |
| 6038 | 1796 |
| 6039 | 1760 |
| 6040 | 1672 |
| 6041 | 1598 |
| 6042 | 1520 |
| 6043 | 1438 |
| 6044 | 1347 |
| 6045 | 1275 |
| 6046 | 1214 |
| 6047 | 1155 |
| 6048 | 1185 |
| 6049 | 1191 |
| 6050 | 1147 |
| 6051 | 1117 |
| 6052 | 1091 |
| 6053 | 1068 |
| 6054 | 1043 |
| 6055 | 1022 |
| 6056 | 1009 |
| 6057 | 996 |
| 6058 | 985 |
| 6059 | 980 |
| 6060 | 981 |
| 6061 | 983 |
| 6062 | 981 |
| 6063 | 984 |
| 6064 | 1013 |
| 6065 | 1020 |
| 6066 | 1038 |
| 6067 | 1069 |
| 6068 | 1105 |
| 6069 | 1123 |
| 6070 | 1164 |
| 6071 | 1207 |
| 6072 | 1333 |
| 6073 | 1422 |
| 6074 | 1478 |
| 6075 | 1524 |
| 6076 | 1575 |
| 6077 | 1600 |
| 6078 | 1609 |
| 6079 | 1612 |
| 6080 | 1617 |
| 6081 | 1583 |
| 6082 | 1546 |
| 6083 | 1508 |
| 6084 | 1460 |
| 6085 | 1435 |
| 6086 | 1410 |
| 6087 | 1375 |
| 6088 | 1332 |
| 6089 | 1255 |
| 6090 | 1186 |
| 6091 | 1178 |
| 6092 | 1209 |
| 6093 | 1248 |
| 6094 | 1260 |
| 6095 | 1246 |
| 6096 | 1192 |
| 6097 | 1153 |
| 6098 | 1112 |
| 6099 | 1120 |
| 6100 | 1077 |
| 6101 | 1075 |
| 6102 | 1102 |
| 6103 | 1080 |
| 6104 | 1092 |
| 6105 | 1082 |
| 6106 | 1053 |
| 6107 | 1053 |
| 6108 | 1087 |
| 6109 | 1153 |
| 6110 | 1219 |
| 6111 | 1240 |
| 6112 | 1291 |
| 6113 | 1354 |
| 6114 | 1435 |
| 6115 | 1518 |
| 6116 | 1605 |
| 6117 | 1676 |
| 6118 | 1757 |
| 6119 | 1840 |
| 6120 | 1916 |
| 6121 | 2020 |
| 6122 | 2131 |
| 6123 | 2202 |
| 6124 | 2203 |
| 6125 | 2164 |
| 6126 | 2123 |
| 6127 | 2082 |
| 6128 | 2005 |
| 6129 | 1933 |
| 6130 | 1868 |
| 6131 | 1812 |
| 6132 | 1798 |
| 6133 | 1760 |
| 6134 | 1768 |
| 6135 | 1746 |
| 6136 | 1664 |
| 6137 | 1599 |
| 6138 | 1538 |
| 6139 | 1460 |
| 6140 | 1384 |
| 6141 | 1315 |
| 6142 | 1253 |
| 6143 | 1200 |
| 6144 | 1220 |
| 6145 | 1218 |
| 6146 | 1171 |
| 6147 | 1132 |
| 6148 | 1094 |
| 6149 | 1061 |
| 6150 | 1031 |
| 6151 | 1005 |
| 6152 | 984 |
| 6153 | 967 |
| 6154 | 956 |
| 6155 | 948 |
| 6156 | 952 |
| 6157 | 949 |
| 6158 | 943 |
| 6159 | 943 |
| 6160 | 953 |
| 6161 | 953 |
| 6162 | 959 |
| 6163 | 969 |
| 6164 | 985 |
| 6165 | 985 |
| 6166 | 989 |
| 6167 | 973 |
| 6168 | 1031 |
| 6169 | 1072 |
| 6170 | 1114 |
| 6171 | 1124 |
| 6172 | 1179 |
| 6173 | 1228 |
| 6174 | 1276 |
| 6175 | 1313 |
| 6176 | 1346 |
| 6177 | 1393 |
| 6178 | 1393 |
| 6179 | 1396 |
| 6180 | 1407 |
| 6181 | 1404 |
| 6182 | 1410 |
| 6183 | 1377 |
| 6184 | 1338 |
| 6185 | 1338 |
| 6186 | 1312 |
| 6187 | 1304 |
| 6188 | 1332 |
| 6189 | 1353 |
| 6190 | 1392 |
| 6191 | 1420 |
| 6192 | 1385 |
| 6193 | 1330 |
| 6194 | 1237 |
| 6195 | 1207 |
| 6196 | 1235 |
| 6197 | 1256 |
| 6198 | 1281 |
| 6199 | 1296 |
| 6200 | 1286 |
| 6201 | 1274 |
| 6202 | 1296 |
| 6203 | 1306 |
| 6204 | 1303 |
| 6205 | 1344 |
| 6206 | 1366 |
| 6207 | 1384 |
| 6208 | 1430 |
| 6209 | 1471 |
| 6210 | 1497 |
| 6211 | 1558 |
| 6212 | 1634 |
| 6213 | 1696 |
| 6214 | 1778 |
| 6215 | 1852 |
| 6216 | 1904 |
| 6217 | 1993 |
| 6218 | 2065 |
| 6219 | 2102 |
| 6220 | 2093 |
| 6221 | 2058 |
| 6222 | 2012 |
| 6223 | 1954 |
| 6224 | 1912 |
| 6225 | 1835 |
| 6226 | 1759 |
| 6227 | 1709 |
| 6228 | 1704 |
| 6229 | 1671 |
| 6230 | 1687 |
| 6231 | 1670 |
| 6232 | 1613 |
| 6233 | 1554 |
| 6234 | 1500 |
| 6235 | 1444 |
| 6236 | 1373 |
| 6237 | 1310 |
| 6238 | 1244 |
| 6239 | 1188 |
| 6240 | 1205 |
| 6241 | 1206 |
| 6242 | 1164 |
| 6243 | 1130 |
| 6244 | 1093 |
| 6245 | 1054 |
| 6246 | 1025 |
| 6247 | 996 |
| 6248 | 972 |
| 6249 | 956 |
| 6250 | 936 |
| 6251 | 929 |
| 6252 | 924 |
| 6253 | 915 |
| 6254 | 911 |
| 6255 | 908 |
| 6256 | 915 |
| 6257 | 904 |
| 6258 | 904 |
| 6259 | 904 |
| 6260 | 911 |
| 6261 | 903 |
| 6262 | 905 |
| 6263 | 889 |
| 6264 | 921 |
| 6265 | 937 |
| 6266 | 952 |
| 6267 | 956 |
| 6268 | 977 |
| 6269 | 1011 |
| 6270 | 1050 |
| 6271 | 1090 |
| 6272 | 1141 |
| 6273 | 1180 |
| 6274 | 1196 |
| 6275 | 1214 |
| 6276 | 1246 |
| 6277 | 1244 |
| 6278 | 1259 |
| 6279 | 1288 |
| 6280 | 1311 |
| 6281 | 1331 |
| 6282 | 1355 |
| 6283 | 1359 |
| 6284 | 1372 |
| 6285 | 1426 |
| 6286 | 1460 |
| 6287 | 1471 |
| 6288 | 1430 |
| 6289 | 1371 |
| 6290 | 1309 |
| 6291 | 1245 |
| 6292 | 1174 |
| 6293 | 1142 |
| 6294 | 1128 |
| 6295 | 1078 |
| 6296 | 1050 |
| 6297 | 1024 |
| 6298 | 1037 |
| 6299 | 1060 |
| 6300 | 1065 |
| 6301 | 1083 |
| 6302 | 1095 |
| 6303 | 1112 |
| 6304 | 1145 |
| 6305 | 1179 |
| 6306 | 1212 |
| 6307 | 1262 |
| 6308 | 1344 |
| 6309 | 1432 |
| 6310 | 1520 |
| 6311 | 1608 |
| 6312 | 1690 |
| 6313 | 1768 |
| 6314 | 1870 |
| 6315 | 1925 |
| 6316 | 1947 |
| 6317 | 1926 |
| 6318 | 1906 |
| 6319 | 1880 |
| 6320 | 1846 |
| 6321 | 1772 |
| 6322 | 1701 |
| 6323 | 1647 |
| 6324 | 1641 |
| 6325 | 1611 |
| 6326 | 1630 |
| 6327 | 1626 |
| 6328 | 1551 |
| 6329 | 1473 |
| 6330 | 1403 |
| 6331 | 1334 |
| 6332 | 1257 |
| 6333 | 1181 |
| 6334 | 1116 |
| 6335 | 1061 |
| 6336 | 1089 |
| 6337 | 1093 |
| 6338 | 1057 |
| 6339 | 1027 |
| 6340 | 998 |
| 6341 | 977 |
| 6342 | 959 |
| 6343 | 936 |
| 6344 | 920 |
| 6345 | 906 |
| 6346 | 897 |
| 6347 | 889 |
| 6348 | 889 |
| 6349 | 887 |
| 6350 | 888 |
| 6351 | 898 |
| 6352 | 924 |
| 6353 | 938 |
| 6354 | 954 |
| 6355 | 984 |
| 6356 | 1033 |
| 6357 | 1050 |
| 6358 | 1094 |
| 6359 | 1144 |
| 6360 | 1274 |
| 6361 | 1354 |
| 6362 | 1388 |
| 6363 | 1428 |
| 6364 | 1484 |
| 6365 | 1512 |
| 6366 | 1540 |
| 6367 | 1573 |
| 6368 | 1608 |
| 6369 | 1595 |
| 6370 | 1570 |
| 6371 | 1547 |
| 6372 | 1513 |
| 6373 | 1493 |
| 6374 | 1472 |
| 6375 | 1448 |
| 6376 | 1453 |
| 6377 | 1447 |
| 6378 | 1453 |
| 6379 | 1448 |
| 6380 | 1475 |
| 6381 | 1508 |
| 6382 | 1517 |
| 6383 | 1495 |
| 6384 | 1442 |
| 6385 | 1381 |
| 6386 | 1374 |
| 6387 | 1402 |
| 6388 | 1400 |
| 6389 | 1422 |
| 6390 | 1438 |
| 6391 | 1426 |
| 6392 | 1433 |
| 6393 | 1412 |
| 6394 | 1410 |
| 6395 | 1406 |
| 6396 | 1404 |
| 6397 | 1424 |
| 6398 | 1433 |
| 6399 | 1429 |
| 6400 | 1454 |
| 6401 | 1489 |
| 6402 | 1508 |
| 6403 | 1533 |
| 6404 | 1594 |
| 6405 | 1653 |
| 6406 | 1741 |
| 6407 | 1823 |
| 6408 | 1883 |
| 6409 | 1968 |
| 6410 | 2083 |
| 6411 | 2174 |
| 6412 | 2188 |
| 6413 | 2170 |
| 6414 | 2140 |
| 6415 | 2096 |
| 6416 | 2045 |
| 6417 | 1971 |
| 6418 | 1887 |
| 6419 | 1822 |
| 6420 | 1803 |
| 6421 | 1756 |
| 6422 | 1765 |
| 6423 | 1728 |
| 6424 | 1634 |
| 6425 | 1558 |
| 6426 | 1478 |
| 6427 | 1398 |
| 6428 | 1314 |
| 6429 | 1242 |
| 6430 | 1178 |
| 6431 | 1131 |
| 6432 | 1159 |
| 6433 | 1166 |
| 6434 | 1131 |
| 6435 | 1099 |
| 6436 | 1071 |
| 6437 | 1044 |
| 6438 | 1020 |
| 6439 | 1003 |
| 6440 | 988 |
| 6441 | 972 |
| 6442 | 961 |
| 6443 | 959 |
| 6444 | 963 |
| 6445 | 965 |
| 6446 | 967 |
| 6447 | 973 |
| 6448 | 997 |
| 6449 | 1001 |
| 6450 | 1020 |
| 6451 | 1045 |
| 6452 | 1086 |
| 6453 | 1099 |
| 6454 | 1140 |
| 6455 | 1188 |
| 6456 | 1314 |
| 6457 | 1398 |
| 6458 | 1435 |
| 6459 | 1452 |
| 6460 | 1516 |
| 6461 | 1536 |
| 6462 | 1534 |
| 6463 | 1539 |
| 6464 | 1542 |
| 6465 | 1523 |
| 6466 | 1472 |
| 6467 | 1448 |
| 6468 | 1401 |
| 6469 | 1366 |
| 6470 | 1330 |
| 6471 | 1280 |
| 6472 | 1274 |
| 6473 | 1238 |
| 6474 | 1215 |
| 6475 | 1177 |
| 6476 | 1152 |
| 6477 | 1177 |
| 6478 | 1221 |
| 6479 | 1237 |
| 6480 | 1217 |
| 6481 | 1195 |
| 6482 | 1161 |
| 6483 | 1125 |
| 6484 | 1107 |
| 6485 | 1128 |
| 6486 | 1153 |
| 6487 | 1150 |
| 6488 | 1165 |
| 6489 | 1191 |
| 6490 | 1206 |
| 6491 | 1230 |
| 6492 | 1264 |
| 6493 | 1257 |
| 6494 | 1273 |
| 6495 | 1279 |
| 6496 | 1332 |
| 6497 | 1388 |
| 6498 | 1447 |
| 6499 | 1499 |
| 6500 | 1575 |
| 6501 | 1665 |
| 6502 | 1749 |
| 6503 | 1830 |
| 6504 | 1905 |
| 6505 | 1977 |
| 6506 | 2079 |
| 6507 | 2177 |
| 6508 | 2183 |
| 6509 | 2160 |
| 6510 | 2120 |
| 6511 | 2078 |
| 6512 | 2022 |
| 6513 | 1946 |
| 6514 | 1871 |
| 6515 | 1810 |
| 6516 | 1776 |
| 6517 | 1722 |
| 6518 | 1726 |
| 6519 | 1679 |
| 6520 | 1592 |
| 6521 | 1508 |
| 6522 | 1430 |
| 6523 | 1349 |
| 6524 | 1260 |
| 6525 | 1184 |
| 6526 | 1117 |
| 6527 | 1066 |
| 6528 | 1091 |
| 6529 | 1097 |
| 6530 | 1063 |
| 6531 | 1035 |
| 6532 | 1006 |
| 6533 | 985 |
| 6534 | 959 |
| 6535 | 946 |
| 6536 | 932 |
| 6537 | 919 |
| 6538 | 919 |
| 6539 | 913 |
| 6540 | 915 |
| 6541 | 917 |
| 6542 | 920 |
| 6543 | 931 |
| 6544 | 963 |
| 6545 | 969 |
| 6546 | 990 |
| 6547 | 1014 |
| 6548 | 1056 |
| 6549 | 1078 |
| 6550 | 1125 |
| 6551 | 1169 |
| 6552 | 1295 |
| 6553 | 1379 |
| 6554 | 1426 |
| 6555 | 1458 |
| 6556 | 1511 |
| 6557 | 1533 |
| 6558 | 1548 |
| 6559 | 1564 |
| 6560 | 1572 |
| 6561 | 1543 |
| 6562 | 1515 |
| 6563 | 1497 |
| 6564 | 1475 |
| 6565 | 1438 |
| 6566 | 1399 |
| 6567 | 1395 |
| 6568 | 1381 |
| 6569 | 1348 |
| 6570 | 1299 |
| 6571 | 1280 |
| 6572 | 1263 |
| 6573 | 1265 |
| 6574 | 1291 |
| 6575 | 1306 |
| 6576 | 1280 |
| 6577 | 1214 |
| 6578 | 1082 |
| 6579 | 1073 |
| 6580 | 1101 |
| 6581 | 1089 |
| 6582 | 1048 |
| 6583 | 1002 |
| 6584 | 1096 |
| 6585 | 1115 |
| 6586 | 1120 |
| 6587 | 1118 |
| 6588 | 1133 |
| 6589 | 1165 |
| 6590 | 1191 |
| 6591 | 1223 |
| 6592 | 1248 |
| 6593 | 1286 |
| 6594 | 1356 |
| 6595 | 1429 |
| 6596 | 1523 |
| 6597 | 1591 |
| 6598 | 1692 |
| 6599 | 1777 |
| 6600 | 1848 |
| 6601 | 1933 |
| 6602 | 2042 |
| 6603 | 2159 |
| 6604 | 2190 |
| 6605 | 2163 |
| 6606 | 2125 |
| 6607 | 2088 |
| 6608 | 2029 |
| 6609 | 1961 |
| 6610 | 1886 |
| 6611 | 1825 |
| 6612 | 1805 |
| 6613 | 1760 |
| 6614 | 1765 |
| 6615 | 1726 |
| 6616 | 1634 |
| 6617 | 1562 |
| 6618 | 1481 |
| 6619 | 1394 |
| 6620 | 1302 |
| 6621 | 1218 |
| 6622 | 1149 |
| 6623 | 1094 |
| 6624 | 1116 |
| 6625 | 1119 |
| 6626 | 1087 |
| 6627 | 1062 |
| 6628 | 1035 |
| 6629 | 1021 |
| 6630 | 995 |
| 6631 | 972 |
| 6632 | 963 |
| 6633 | 954 |
| 6634 | 949 |
| 6635 | 947 |
| 6636 | 953 |
| 6637 | 954 |
| 6638 | 959 |
| 6639 | 963 |
| 6640 | 992 |
| 6641 | 1000 |
| 6642 | 1020 |
| 6643 | 1049 |
| 6644 | 1094 |
| 6645 | 1110 |
| 6646 | 1156 |
| 6647 | 1202 |
| 6648 | 1327 |
| 6649 | 1409 |
| 6650 | 1445 |
| 6651 | 1467 |
| 6652 | 1526 |
| 6653 | 1546 |
| 6654 | 1542 |
| 6655 | 1535 |
| 6656 | 1527 |
| 6657 | 1491 |
| 6658 | 1442 |
| 6659 | 1397 |
| 6660 | 1334 |
| 6661 | 1278 |
| 6662 | 1243 |
| 6663 | 1206 |
| 6664 | 1185 |
| 6665 | 1146 |
| 6666 | 1076 |
| 6667 | 1032 |
| 6668 | 988 |
| 6669 | 978 |
| 6670 | 976 |
| 6671 | 974 |
| 6672 | 943 |
| 6673 | 897 |
| 6674 | 851 |
| 6675 | 830 |
| 6676 | 816 |
| 6677 | 822 |
| 6678 | 845 |
| 6679 | 838 |
| 6680 | 854 |
| 6681 | 860 |
| 6682 | 889 |
| 6683 | 910 |
| 6684 | 948 |
| 6685 | 984 |
| 6686 | 1022 |
| 6687 | 1057 |
| 6688 | 1116 |
| 6689 | 1181 |
| 6690 | 1248 |
| 6691 | 1336 |
| 6692 | 1415 |
| 6693 | 1509 |
| 6694 | 1612 |
| 6695 | 1704 |
| 6696 | 1787 |
| 6697 | 1867 |
| 6698 | 1995 |
| 6699 | 2115 |
| 6700 | 2161 |
| 6701 | 2154 |
| 6702 | 2128 |
| 6703 | 2091 |
| 6704 | 2032 |
| 6705 | 1952 |
| 6706 | 1881 |
| 6707 | 1824 |
| 6708 | 1786 |
| 6709 | 1739 |
| 6710 | 1735 |
| 6711 | 1698 |
| 6712 | 1607 |
| 6713 | 1529 |
| 6714 | 1453 |
| 6715 | 1373 |
| 6716 | 1283 |
| 6717 | 1212 |
| 6718 | 1147 |
| 6719 | 1088 |
| 6720 | 1105 |
| 6721 | 1102 |
| 6722 | 1058 |
| 6723 | 1032 |
| 6724 | 1007 |
| 6725 | 986 |
| 6726 | 964 |
| 6727 | 947 |
| 6728 | 938 |
| 6729 | 921 |
| 6730 | 908 |
| 6731 | 903 |
| 6732 | 909 |
| 6733 | 912 |
| 6734 | 912 |
| 6735 | 920 |
| 6736 | 949 |
| 6737 | 957 |
| 6738 | 975 |
| 6739 | 1004 |
| 6740 | 1040 |
| 6741 | 1059 |
| 6742 | 1106 |
| 6743 | 1158 |
| 6744 | 1279 |
| 6745 | 1345 |
| 6746 | 1390 |
| 6747 | 1414 |
| 6748 | 1463 |
| 6749 | 1486 |
| 6750 | 1479 |
| 6751 | 1469 |
| 6752 | 1454 |
| 6753 | 1406 |
| 6754 | 1359 |
| 6755 | 1292 |
| 6756 | 1227 |
| 6757 | 1176 |
| 6758 | 1132 |
| 6759 | 1094 |
| 6760 | 1057 |
| 6761 | 1020 |
| 6762 | 969 |
| 6763 | 923 |
| 6764 | 905 |
| 6765 | 923 |
| 6766 | 934 |
| 6767 | 937 |
| 6768 | 928 |
| 6769 | 893 |
| 6770 | 836 |
| 6771 | 845 |
| 6772 | 924 |
| 6773 | 971 |
| 6774 | 990 |
| 6775 | 1048 |
| 6776 | 1092 |
| 6777 | 1097 |
| 6778 | 1124 |
| 6779 | 1153 |
| 6780 | 1195 |
| 6781 | 1215 |
| 6782 | 1236 |
| 6783 | 1263 |
| 6784 | 1319 |
| 6785 | 1381 |
| 6786 | 1442 |
| 6787 | 1517 |
| 6788 | 1593 |
| 6789 | 1671 |
| 6790 | 1750 |
| 6791 | 1816 |
| 6792 | 1871 |
| 6793 | 1954 |
| 6794 | 2071 |
| 6795 | 2149 |
| 6796 | 2155 |
| 6797 | 2113 |
| 6798 | 2069 |
| 6799 | 2034 |
| 6800 | 1974 |
| 6801 | 1905 |
| 6802 | 1841 |
| 6803 | 1782 |
| 6804 | 1762 |
| 6805 | 1722 |
| 6806 | 1724 |
| 6807 | 1702 |
| 6808 | 1616 |
| 6809 | 1550 |
| 6810 | 1487 |
| 6811 | 1417 |
| 6812 | 1341 |
| 6813 | 1270 |
| 6814 | 1207 |
| 6815 | 1151 |
| 6816 | 1170 |
| 6817 | 1164 |
| 6818 | 1123 |
| 6819 | 1080 |
| 6820 | 1044 |
| 6821 | 1016 |
| 6822 | 990 |
| 6823 | 966 |
| 6824 | 947 |
| 6825 | 929 |
| 6826 | 922 |
| 6827 | 912 |
| 6828 | 915 |
| 6829 | 914 |
| 6830 | 907 |
| 6831 | 907 |
| 6832 | 920 |
| 6833 | 915 |
| 6834 | 924 |
| 6835 | 935 |
| 6836 | 953 |
| 6837 | 954 |
| 6838 | 963 |
| 6839 | 955 |
| 6840 | 1012 |
| 6841 | 1052 |
| 6842 | 1077 |
| 6843 | 1090 |
| 6844 | 1159 |
| 6845 | 1203 |
| 6846 | 1256 |
| 6847 | 1304 |
| 6848 | 1353 |
| 6849 | 1400 |
| 6850 | 1410 |
| 6851 | 1413 |
| 6852 | 1424 |
| 6853 | 1438 |
| 6854 | 1448 |
| 6855 | 1430 |
| 6856 | 1411 |
| 6857 | 1436 |
| 6858 | 1428 |
| 6859 | 1436 |
| 6860 | 1472 |
| 6861 | 1519 |
| 6862 | 1551 |
| 6863 | 1533 |
| 6864 | 1418 |
| 6865 | 1322 |
| 6866 | 1228 |
| 6867 | 1226 |
| 6868 | 1249 |
| 6869 | 1278 |
| 6870 | 1286 |
| 6871 | 1276 |
| 6872 | 1286 |
| 6873 | 1269 |
| 6874 | 1300 |
| 6875 | 1293 |
| 6876 | 1292 |
| 6877 | 1316 |
| 6878 | 1332 |
| 6879 | 1346 |
| 6880 | 1385 |
| 6881 | 1424 |
| 6882 | 1450 |
| 6883 | 1502 |
| 6884 | 1571 |
| 6885 | 1634 |
| 6886 | 1705 |
| 6887 | 1771 |
| 6888 | 1824 |
| 6889 | 1895 |
| 6890 | 1974 |
| 6891 | 2038 |
| 6892 | 2060 |
| 6893 | 2041 |
| 6894 | 1996 |
| 6895 | 1949 |
| 6896 | 1905 |
| 6897 | 1828 |
| 6898 | 1751 |
| 6899 | 1701 |
| 6900 | 1692 |
| 6901 | 1661 |
| 6902 | 1669 |
| 6903 | 1649 |
| 6904 | 1594 |
| 6905 | 1532 |
| 6906 | 1472 |
| 6907 | 1420 |
| 6908 | 1350 |
| 6909 | 1283 |
| 6910 | 1214 |
| 6911 | 1153 |
| 6912 | 1163 |
| 6913 | 1162 |
| 6914 | 1119 |
| 6915 | 1083 |
| 6916 | 1050 |
| 6917 | 1016 |
| 6918 | 987 |
| 6919 | 958 |
| 6920 | 937 |
| 6921 | 921 |
| 6922 | 902 |
| 6923 | 893 |
| 6924 | 888 |
| 6925 | 883 |
| 6926 | 876 |
| 6927 | 875 |
| 6928 | 880 |
| 6929 | 870 |
| 6930 | 869 |
| 6931 | 873 |
| 6932 | 881 |
| 6933 | 876 |
| 6934 | 876 |
| 6935 | 862 |
| 6936 | 895 |
| 6937 | 899 |
| 6938 | 908 |
| 6939 | 909 |
| 6940 | 942 |
| 6941 | 972 |
| 6942 | 1002 |
| 6943 | 1039 |
| 6944 | 1086 |
| 6945 | 1118 |
| 6946 | 1137 |
| 6947 | 1155 |
| 6948 | 1176 |
| 6949 | 1201 |
| 6950 | 1225 |
| 6951 | 1238 |
| 6952 | 1228 |
| 6953 | 1210 |
| 6954 | 1214 |
| 6955 | 1242 |
| 6956 | 1284 |
| 6957 | 1359 |
| 6958 | 1413 |
| 6959 | 1403 |
| 6960 | 1352 |
| 6961 | 1288 |
| 6962 | 1231 |
| 6963 | 1182 |
| 6964 | 1137 |
| 6965 | 1111 |
| 6966 | 1070 |
| 6967 | 1014 |
| 6968 | 997 |
| 6969 | 1006 |
| 6970 | 992 |
| 6971 | 1010 |
| 6972 | 997 |
| 6973 | 1036 |
| 6974 | 1069 |
| 6975 | 1086 |
| 6976 | 1100 |
| 6977 | 1139 |
| 6978 | 1187 |
| 6979 | 1258 |
| 6980 | 1325 |
| 6981 | 1394 |
| 6982 | 1476 |
| 6983 | 1552 |
| 6984 | 1616 |
| 6985 | 1687 |
| 6986 | 1782 |
| 6987 | 1856 |
| 6988 | 1922 |
| 6989 | 1918 |
| 6990 | 1903 |
| 6991 | 1875 |
| 6992 | 1838 |
| 6993 | 1757 |
| 6994 | 1685 |
| 6995 | 1627 |
| 6996 | 1623 |
| 6997 | 1594 |
| 6998 | 1605 |
| 6999 | 1595 |
| 7000 | 1519 |
| 7001 | 1439 |
| 7002 | 1363 |
| 7003 | 1292 |
| 7004 | 1218 |
| 7005 | 1143 |
| 7006 | 1082 |
| 7007 | 1024 |
| 7008 | 1048 |
| 7009 | 1054 |
| 7010 | 1021 |
| 7011 | 992 |
| 7012 | 963 |
| 7013 | 945 |
| 7014 | 929 |
| 7015 | 909 |
| 7016 | 897 |
| 7017 | 885 |
| 7018 | 877 |
| 7019 | 872 |
| 7020 | 875 |
| 7021 | 876 |
| 7022 | 878 |
| 7023 | 883 |
| 7024 | 913 |
| 7025 | 924 |
| 7026 | 944 |
| 7027 | 976 |
| 7028 | 1023 |
| 7029 | 1046 |
| 7030 | 1101 |
| 7031 | 1165 |
| 7032 | 1288 |
| 7033 | 1364 |
| 7034 | 1393 |
| 7035 | 1428 |
| 7036 | 1472 |
| 7037 | 1481 |
| 7038 | 1501 |
| 7039 | 1525 |
| 7040 | 1547 |
| 7041 | 1539 |
| 7042 | 1517 |
| 7043 | 1483 |
| 7044 | 1432 |
| 7045 | 1399 |
| 7046 | 1371 |
| 7047 | 1331 |
| 7048 | 1303 |
| 7049 | 1262 |
| 7050 | 1225 |
| 7051 | 1189 |
| 7052 | 1209 |
| 7053 | 1243 |
| 7054 | 1269 |
| 7055 | 1266 |
| 7056 | 1245 |
| 7057 | 1234 |
| 7058 | 1213 |
| 7059 | 1198 |
| 7060 | 1201 |
| 7061 | 1216 |
| 7062 | 1247 |
| 7063 | 1259 |
| 7064 | 1282 |
| 7065 | 1235 |
| 7066 | 1223 |
| 7067 | 1194 |
| 7068 | 1226 |
| 7069 | 1288 |
| 7070 | 1340 |
| 7071 | 1362 |
| 7072 | 1392 |
| 7073 | 1413 |
| 7074 | 1436 |
| 7075 | 1446 |
| 7076 | 1492 |
| 7077 | 1559 |
| 7078 | 1649 |
| 7079 | 1733 |
| 7080 | 1798 |
| 7081 | 1871 |
| 7082 | 1984 |
| 7083 | 2097 |
| 7084 | 2154 |
| 7085 | 2157 |
| 7086 | 2133 |
| 7087 | 2099 |
| 7088 | 2049 |
| 7089 | 1965 |
| 7090 | 1883 |
| 7091 | 1819 |
| 7092 | 1797 |
| 7093 | 1747 |
| 7094 | 1748 |
| 7095 | 1708 |
| 7096 | 1616 |
| 7097 | 1538 |
| 7098 | 1450 |
| 7099 | 1367 |
| 7100 | 1281 |
| 7101 | 1207 |
| 7102 | 1141 |
| 7103 | 1096 |
| 7104 | 1123 |
| 7105 | 1131 |
| 7106 | 1095 |
| 7107 | 1066 |
| 7108 | 1043 |
| 7109 | 1018 |
| 7110 | 997 |
| 7111 | 981 |
| 7112 | 966 |
| 7113 | 951 |
| 7114 | 943 |
| 7115 | 941 |
| 7116 | 944 |
| 7117 | 946 |
| 7118 | 946 |
| 7119 | 955 |
| 7120 | 980 |
| 7121 | 986 |
| 7122 | 1006 |
| 7123 | 1031 |
| 7124 | 1075 |
| 7125 | 1092 |
| 7126 | 1136 |
| 7127 | 1192 |
| 7128 | 1306 |
| 7129 | 1382 |
| 7130 | 1412 |
| 7131 | 1434 |
| 7132 | 1485 |
| 7133 | 1494 |
| 7134 | 1487 |
| 7135 | 1478 |
| 7136 | 1468 |
| 7137 | 1432 |
| 7138 | 1379 |
| 7139 | 1353 |
| 7140 | 1313 |
| 7141 | 1284 |
| 7142 | 1247 |
| 7143 | 1211 |
| 7144 | 1219 |
| 7145 | 1198 |
| 7146 | 1210 |
| 7147 | 1205 |
| 7148 | 1180 |
| 7149 | 1198 |
| 7150 | 1238 |
| 7151 | 1265 |
| 7152 | 1265 |
| 7153 | 1281 |
| 7154 | 1265 |
| 7155 | 1260 |
| 7156 | 1274 |
| 7157 | 1303 |
| 7158 | 1322 |
| 7159 | 1291 |
| 7160 | 1262 |
| 7161 | 1228 |
| 7162 | 1218 |
| 7163 | 1215 |
| 7164 | 1235 |
| 7165 | 1230 |
| 7166 | 1250 |
| 7167 | 1244 |
| 7168 | 1275 |
| 7169 | 1321 |
| 7170 | 1380 |
| 7171 | 1454 |
| 7172 | 1540 |
| 7173 | 1622 |
| 7174 | 1704 |
| 7175 | 1782 |
| 7176 | 1840 |
| 7177 | 1899 |
| 7178 | 1993 |
| 7179 | 2107 |
| 7180 | 2161 |
| 7181 | 2158 |
| 7182 | 2127 |
| 7183 | 2083 |
| 7184 | 2021 |
| 7185 | 1942 |
| 7186 | 1864 |
| 7187 | 1805 |
| 7188 | 1771 |
| 7189 | 1711 |
| 7190 | 1706 |
| 7191 | 1660 |
| 7192 | 1579 |
| 7193 | 1496 |
| 7194 | 1420 |
| 7195 | 1338 |
| 7196 | 1247 |
| 7197 | 1174 |
| 7198 | 1107 |
| 7199 | 1054 |
| 7200 | 1080 |
| 7201 | 1085 |
| 7202 | 1049 |
| 7203 | 1018 |
| 7204 | 994 |
| 7205 | 974 |
| 7206 | 951 |
| 7207 | 936 |
| 7208 | 921 |
| 7209 | 914 |
| 7210 | 916 |
| 7211 | 909 |
| 7212 | 913 |
| 7213 | 912 |
| 7214 | 912 |
| 7215 | 924 |
| 7216 | 954 |
| 7217 | 960 |
| 7218 | 981 |
| 7219 | 1005 |
| 7220 | 1049 |
| 7221 | 1074 |
| 7222 | 1127 |
| 7223 | 1170 |
| 7224 | 1272 |
| 7225 | 1344 |
| 7226 | 1381 |
| 7227 | 1413 |
| 7228 | 1461 |
| 7229 | 1474 |
| 7230 | 1487 |
| 7231 | 1495 |
| 7232 | 1499 |
| 7233 | 1470 |
| 7234 | 1444 |
| 7235 | 1397 |
| 7236 | 1341 |
| 7237 | 1301 |
| 7238 | 1270 |
| 7239 | 1237 |
| 7240 | 1214 |
| 7241 | 1205 |
| 7242 | 1232 |
| 7243 | 1248 |
| 7244 | 1244 |
| 7245 | 1248 |
| 7246 | 1288 |
| 7247 | 1324 |
| 7248 | 1299 |
| 7249 | 1246 |
| 7250 | 1121 |
| 7251 | 1078 |
| 7252 | 1093 |
| 7253 | 1037 |
| 7254 | 999 |
| 7255 | 965 |
| 7256 | 1084 |
| 7257 | 1110 |
| 7258 | 1125 |
| 7259 | 1103 |
| 7260 | 1111 |
| 7261 | 1130 |
| 7262 | 1149 |
| 7263 | 1182 |
| 7264 | 1216 |
| 7265 | 1273 |
| 7266 | 1330 |
| 7267 | 1398 |
| 7268 | 1496 |
| 7269 | 1545 |
| 7270 | 1625 |
| 7271 | 1704 |
| 7272 | 1773 |
| 7273 | 1858 |
| 7274 | 1952 |
| 7275 | 2073 |
| 7276 | 2140 |
| 7277 | 2129 |
| 7278 | 2097 |
| 7279 | 2056 |
| 7280 | 1999 |
| 7281 | 1926 |
| 7282 | 1852 |
| 7283 | 1798 |
| 7284 | 1770 |
| 7285 | 1720 |
| 7286 | 1719 |
| 7287 | 1678 |
| 7288 | 1586 |
| 7289 | 1506 |
| 7290 | 1422 |
| 7291 | 1340 |
| 7292 | 1249 |
| 7293 | 1173 |
| 7294 | 1113 |
| 7295 | 1060 |
| 7296 | 1082 |
| 7297 | 1082 |
| 7298 | 1048 |
| 7299 | 1021 |
| 7300 | 998 |
| 7301 | 982 |
| 7302 | 957 |
| 7303 | 934 |
| 7304 | 924 |
| 7305 | 915 |
| 7306 | 908 |
| 7307 | 909 |
| 7308 | 915 |
| 7309 | 924 |
| 7310 | 932 |
| 7311 | 935 |
| 7312 | 963 |
| 7313 | 970 |
| 7314 | 990 |
| 7315 | 1016 |
| 7316 | 1067 |
| 7317 | 1087 |
| 7318 | 1134 |
| 7319 | 1176 |
| 7320 | 1276 |
| 7321 | 1345 |
| 7322 | 1373 |
| 7323 | 1396 |
| 7324 | 1436 |
| 7325 | 1432 |
| 7326 | 1429 |
| 7327 | 1417 |
| 7328 | 1387 |
| 7329 | 1327 |
| 7330 | 1262 |
| 7331 | 1206 |
| 7332 | 1139 |
| 7333 | 1090 |
| 7334 | 1044 |
| 7335 | 1001 |
| 7336 | 973 |
| 7337 | 946 |
| 7338 | 901 |
| 7339 | 876 |
| 7340 | 865 |
| 7341 | 866 |
| 7342 | 873 |
| 7343 | 876 |
| 7344 | 845 |
| 7345 | 797 |
| 7346 | 755 |
| 7347 | 732 |
| 7348 | 727 |
| 7349 | 744 |
| 7350 | 771 |
| 7351 | 784 |
| 7352 | 792 |
| 7353 | 789 |
| 7354 | 844 |
| 7355 | 840 |
| 7356 | 884 |
| 7357 | 906 |
| 7358 | 955 |
| 7359 | 980 |
| 7360 | 1050 |
| 7361 | 1107 |
| 7362 | 1154 |
| 7363 | 1236 |
| 7364 | 1329 |
| 7365 | 1424 |
| 7366 | 1524 |
| 7367 | 1608 |
| 7368 | 1693 |
| 7369 | 1773 |
| 7370 | 1873 |
| 7371 | 1996 |
| 7372 | 2079 |
| 7373 | 2098 |
| 7374 | 2082 |
| 7375 | 2048 |
| 7376 | 1984 |
| 7377 | 1907 |
| 7378 | 1835 |
| 7379 | 1777 |
| 7380 | 1744 |
| 7381 | 1692 |
| 7382 | 1678 |
| 7383 | 1646 |
| 7384 | 1553 |
| 7385 | 1475 |
| 7386 | 1393 |
| 7387 | 1316 |
| 7388 | 1224 |
| 7389 | 1155 |
| 7390 | 1090 |
| 7391 | 1038 |
| 7392 | 1051 |
| 7393 | 1045 |
| 7394 | 1006 |
| 7395 | 980 |
| 7396 | 958 |
| 7397 | 935 |
| 7398 | 912 |
| 7399 | 894 |
| 7400 | 886 |
| 7401 | 872 |
| 7402 | 862 |
| 7403 | 856 |
| 7404 | 864 |
| 7405 | 870 |
| 7406 | 872 |
| 7407 | 880 |
| 7408 | 914 |
| 7409 | 925 |
| 7410 | 940 |
| 7411 | 964 |
| 7412 | 1005 |
| 7413 | 1027 |
| 7414 | 1073 |
| 7415 | 1129 |
| 7416 | 1230 |
| 7417 | 1284 |
| 7418 | 1316 |
| 7419 | 1342 |
| 7420 | 1381 |
| 7421 | 1390 |
| 7422 | 1386 |
| 7423 | 1369 |
| 7424 | 1353 |
| 7425 | 1303 |
| 7426 | 1256 |
| 7427 | 1192 |
| 7428 | 1125 |
| 7429 | 1073 |
| 7430 | 1040 |
| 7431 | 1005 |
| 7432 | 970 |
| 7433 | 924 |
| 7434 | 883 |
| 7435 | 851 |
| 7436 | 842 |
| 7437 | 862 |
| 7438 | 879 |
| 7439 | 882 |
| 7440 | 879 |
| 7441 | 842 |
| 7442 | 790 |
| 7443 | 805 |
| 7444 | 883 |
| 7445 | 941 |
| 7446 | 933 |
| 7447 | 980 |
| 7448 | 1033 |
| 7449 | 1033 |
| 7450 | 1070 |
| 7451 | 1098 |
| 7452 | 1128 |
| 7453 | 1160 |
| 7454 | 1185 |
| 7455 | 1214 |
| 7456 | 1261 |
| 7457 | 1315 |
| 7458 | 1374 |
| 7459 | 1437 |
| 7460 | 1517 |
| 7461 | 1593 |
| 7462 | 1667 |
| 7463 | 1720 |
| 7464 | 1767 |
| 7465 | 1833 |
| 7466 | 1923 |
| 7467 | 2020 |
| 7468 | 2072 |
| 7469 | 2064 |
| 7470 | 2033 |
| 7471 | 2001 |
| 7472 | 1949 |
| 7473 | 1885 |
| 7474 | 1822 |
| 7475 | 1766 |
| 7476 | 1742 |
| 7477 | 1697 |
| 7478 | 1695 |
| 7479 | 1674 |
| 7480 | 1587 |
| 7481 | 1524 |
| 7482 | 1460 |
| 7483 | 1386 |
| 7484 | 1307 |
| 7485 | 1239 |
| 7486 | 1170 |
| 7487 | 1118 |
| 7488 | 1133 |
| 7489 | 1120 |
| 7490 | 1077 |
| 7491 | 1035 |
| 7492 | 1002 |
| 7493 | 975 |
| 7494 | 953 |
| 7495 | 928 |
| 7496 | 908 |
| 7497 | 890 |
| 7498 | 884 |
| 7499 | 880 |
| 7500 | 885 |
| 7501 | 883 |
| 7502 | 878 |
| 7503 | 879 |
| 7504 | 899 |
| 7505 | 893 |
| 7506 | 899 |
| 7507 | 906 |
| 7508 | 930 |
| 7509 | 932 |
| 7510 | 944 |
| 7511 | 931 |
| 7512 | 981 |
| 7513 | 1015 |
| 7514 | 1030 |
| 7515 | 1048 |
| 7516 | 1102 |
| 7517 | 1144 |
| 7518 | 1186 |
| 7519 | 1226 |
| 7520 | 1277 |
| 7521 | 1325 |
| 7522 | 1344 |
| 7523 | 1340 |
| 7524 | 1346 |
| 7525 | 1355 |
| 7526 | 1360 |
| 7527 | 1340 |
| 7528 | 1318 |
| 7529 | 1339 |
| 7530 | 1332 |
| 7531 | 1347 |
| 7532 | 1375 |
| 7533 | 1406 |
| 7534 | 1430 |
| 7535 | 1406 |
| 7536 | 1315 |
| 7537 | 1227 |
| 7538 | 1145 |
| 7539 | 1144 |
| 7540 | 1167 |
| 7541 | 1195 |
| 7542 | 1202 |
| 7543 | 1195 |
| 7544 | 1212 |
| 7545 | 1196 |
| 7546 | 1237 |
| 7547 | 1237 |
| 7548 | 1240 |
| 7549 | 1256 |
| 7550 | 1267 |
| 7551 | 1280 |
| 7552 | 1314 |
| 7553 | 1351 |
| 7554 | 1375 |
| 7555 | 1430 |
| 7556 | 1500 |
| 7557 | 1573 |
| 7558 | 1639 |
| 7559 | 1694 |
| 7560 | 1748 |
| 7561 | 1811 |
| 7562 | 1868 |
| 7563 | 1941 |
| 7564 | 1996 |
| 7565 | 2013 |
| 7566 | 1971 |
| 7567 | 1934 |
| 7568 | 1890 |
| 7569 | 1809 |
| 7570 | 1740 |
| 7571 | 1683 |
| 7572 | 1668 |
| 7573 | 1635 |
| 7574 | 1639 |
| 7575 | 1615 |
| 7576 | 1554 |
| 7577 | 1489 |
| 7578 | 1430 |
| 7579 | 1378 |
| 7580 | 1313 |
| 7581 | 1242 |
| 7582 | 1177 |
| 7583 | 1120 |
| 7584 | 1157 |
| 7585 | 1157 |
| 7586 | 1110 |
| 7587 | 1071 |
| 7588 | 1039 |
| 7589 | 1008 |
| 7590 | 979 |
| 7591 | 948 |
| 7592 | 931 |
| 7593 | 913 |
| 7594 | 891 |
| 7595 | 880 |
| 7596 | 871 |
| 7597 | 869 |
| 7598 | 856 |
| 7599 | 854 |
| 7600 | 864 |
| 7601 | 855 |
| 7602 | 851 |
| 7603 | 852 |
| 7604 | 861 |
| 7605 | 856 |
| 7606 | 854 |
| 7607 | 845 |
| 7608 | 877 |
| 7609 | 868 |
| 7610 | 885 |
| 7611 | 889 |
| 7612 | 925 |
| 7613 | 956 |
| 7614 | 990 |
| 7615 | 1039 |
| 7616 | 1107 |
| 7617 | 1149 |
| 7618 | 1191 |
| 7619 | 1228 |
| 7620 | 1252 |
| 7621 | 1299 |
| 7622 | 1341 |
| 7623 | 1371 |
| 7624 | 1367 |
| 7625 | 1338 |
| 7626 | 1335 |
| 7627 | 1385 |
| 7628 | 1449 |
| 7629 | 1545 |
| 7630 | 1626 |
| 7631 | 1622 |
| 7632 | 1566 |
| 7633 | 1504 |
| 7634 | 1457 |
| 7635 | 1417 |
| 7636 | 1382 |
| 7637 | 1364 |
| 7638 | 1307 |
| 7639 | 1239 |
| 7640 | 1215 |
| 7641 | 1235 |
| 7642 | 1198 |
| 7643 | 1209 |
| 7644 | 1172 |
| 7645 | 1227 |
| 7646 | 1266 |
| 7647 | 1267 |
| 7648 | 1247 |
| 7649 | 1272 |
| 7650 | 1308 |
| 7651 | 1364 |
| 7652 | 1398 |
| 7653 | 1433 |
| 7654 | 1494 |
| 7655 | 1558 |
| 7656 | 1607 |
| 7657 | 1672 |
| 7658 | 1759 |
| 7659 | 1827 |
| 7660 | 1919 |
| 7661 | 1934 |
| 7662 | 1927 |
| 7663 | 1898 |
| 7664 | 1855 |
| 7665 | 1772 |
| 7666 | 1703 |
| 7667 | 1646 |
| 7668 | 1644 |
| 7669 | 1617 |
| 7670 | 1624 |
| 7671 | 1614 |
| 7672 | 1541 |
| 7673 | 1465 |
| 7674 | 1384 |
| 7675 | 1311 |
| 7676 | 1238 |
| 7677 | 1160 |
| 7678 | 1101 |
| 7679 | 1040 |
| 7680 | 1064 |
| 7681 | 1070 |
| 7682 | 1035 |
| 7683 | 1008 |
| 7684 | 978 |
| 7685 | 962 |
| 7686 | 947 |
| 7687 | 926 |
| 7688 | 915 |
| 7689 | 909 |
| 7690 | 900 |
| 7691 | 895 |
| 7692 | 896 |
| 7693 | 898 |
| 7694 | 901 |
| 7695 | 900 |
| 7696 | 932 |
| 7697 | 939 |
| 7698 | 960 |
| 7699 | 986 |
| 7700 | 1033 |
| 7701 | 1053 |
| 7702 | 1109 |
| 7703 | 1173 |
| 7704 | 1272 |
| 7705 | 1335 |
| 7706 | 1378 |
| 7707 | 1407 |
| 7708 | 1434 |
| 7709 | 1428 |
| 7710 | 1449 |
| 7711 | 1475 |
| 7712 | 1498 |
| 7713 | 1514 |
| 7714 | 1495 |
| 7715 | 1461 |
| 7716 | 1417 |
| 7717 | 1390 |
| 7718 | 1388 |
| 7719 | 1344 |
| 7720 | 1313 |
| 7721 | 1265 |
| 7722 | 1223 |
| 7723 | 1182 |
| 7724 | 1216 |
| 7725 | 1264 |
| 7726 | 1309 |
| 7727 | 1293 |
| 7728 | 1283 |
| 7729 | 1282 |
| 7730 | 1283 |
| 7731 | 1271 |
| 7732 | 1277 |
| 7733 | 1286 |
| 7734 | 1351 |
| 7735 | 1384 |
| 7736 | 1431 |
| 7737 | 1366 |
| 7738 | 1332 |
| 7739 | 1272 |
| 7740 | 1315 |
| 7741 | 1404 |
| 7742 | 1478 |
| 7743 | 1498 |
| 7744 | 1516 |
| 7745 | 1509 |
| 7746 | 1514 |
| 7747 | 1487 |
| 7748 | 1503 |
| 7749 | 1564 |
| 7750 | 1642 |
| 7751 | 1725 |
| 7752 | 1798 |
| 7753 | 1869 |
| 7754 | 1965 |
| 7755 | 2071 |
| 7756 | 2160 |
| 7757 | 2181 |
| 7758 | 2164 |
| 7759 | 2140 |
| 7760 | 2087 |
| 7761 | 1994 |
| 7762 | 1919 |
| 7763 | 1856 |
| 7764 | 1840 |
| 7765 | 1783 |
| 7766 | 1781 |
| 7767 | 1742 |
| 7768 | 1645 |
| 7769 | 1563 |
| 7770 | 1474 |
| 7771 | 1387 |
| 7772 | 1303 |
| 7773 | 1230 |
| 7774 | 1165 |
| 7775 | 1117 |
| 7776 | 1146 |
| 7777 | 1153 |
| 7778 | 1113 |
| 7779 | 1085 |
| 7780 | 1065 |
| 7781 | 1042 |
| 7782 | 1024 |
| 7783 | 1005 |
| 7784 | 989 |
| 7785 | 975 |
| 7786 | 970 |
| 7787 | 964 |
| 7788 | 964 |
| 7789 | 964 |
| 7790 | 963 |
| 7791 | 972 |
| 7792 | 1000 |
| 7793 | 1009 |
| 7794 | 1027 |
| 7795 | 1049 |
| 7796 | 1096 |
| 7797 | 1116 |
| 7798 | 1159 |
| 7799 | 1211 |
| 7800 | 1308 |
| 7801 | 1373 |
| 7802 | 1412 |
| 7803 | 1426 |
| 7804 | 1470 |
| 7805 | 1481 |
| 7806 | 1477 |
| 7807 | 1465 |
| 7808 | 1448 |
| 7809 | 1407 |
| 7810 | 1358 |
| 7811 | 1334 |
| 7812 | 1292 |
| 7813 | 1265 |
| 7814 | 1225 |
| 7815 | 1204 |
| 7816 | 1227 |
| 7817 | 1228 |
| 7818 | 1266 |
| 7819 | 1286 |
| 7820 | 1252 |
| 7821 | 1263 |
| 7822 | 1307 |
| 7823 | 1339 |
| 7824 | 1357 |
| 7825 | 1412 |
| 7826 | 1412 |
| 7827 | 1431 |
| 7828 | 1476 |
| 7829 | 1513 |
| 7830 | 1531 |
| 7831 | 1472 |
| 7832 | 1391 |
| 7833 | 1304 |
| 7834 | 1270 |
| 7835 | 1260 |
| 7836 | 1270 |
| 7837 | 1250 |
| 7838 | 1264 |
| 7839 | 1248 |
| 7840 | 1273 |
| 7841 | 1321 |
| 7842 | 1381 |
| 7843 | 1471 |
| 7844 | 1560 |
| 7845 | 1633 |
| 7846 | 1709 |
| 7847 | 1793 |
| 7848 | 1854 |
| 7849 | 1904 |
| 7850 | 1996 |
| 7851 | 2096 |
| 7852 | 2190 |
| 7853 | 2198 |
| 7854 | 2174 |
| 7855 | 2128 |
| 7856 | 2058 |
| 7857 | 1977 |
| 7858 | 1896 |
| 7859 | 1841 |
| 7860 | 1811 |
| 7861 | 1748 |
| 7862 | 1742 |
| 7863 | 1694 |
| 7864 | 1624 |
| 7865 | 1550 |
| 7866 | 1474 |
| 7867 | 1393 |
| 7868 | 1303 |
| 7869 | 1228 |
| 7870 | 1160 |
| 7871 | 1101 |
| 7872 | 1131 |
| 7873 | 1135 |
| 7874 | 1094 |
| 7875 | 1064 |
| 7876 | 1042 |
| 7877 | 1021 |
| 7878 | 994 |
| 7879 | 978 |
| 7880 | 962 |
| 7881 | 955 |
| 7882 | 954 |
| 7883 | 946 |
| 7884 | 946 |
| 7885 | 944 |
| 7886 | 941 |
| 7887 | 953 |
| 7888 | 980 |
| 7889 | 986 |
| 7890 | 1000 |
| 7891 | 1027 |
| 7892 | 1069 |
| 7893 | 1097 |
| 7894 | 1154 |
| 7895 | 1192 |
| 7896 | 1269 |
| 7897 | 1333 |
| 7898 | 1379 |
| 7899 | 1409 |
| 7900 | 1450 |
| 7901 | 1459 |
| 7902 | 1477 |
| 7903 | 1476 |
| 7904 | 1479 |
| 7905 | 1460 |
| 7906 | 1442 |
| 7907 | 1382 |
| 7908 | 1322 |
| 7909 | 1284 |
| 7910 | 1251 |
| 7911 | 1221 |
| 7912 | 1207 |
| 7913 | 1207 |
| 7914 | 1261 |
| 7915 | 1301 |
| 7916 | 1299 |
| 7917 | 1323 |
| 7918 | 1405 |
| 7919 | 1469 |
| 7920 | 1418 |
| 7921 | 1377 |
| 7922 | 1263 |
| 7923 | 1207 |
| 7924 | 1208 |
| 7925 | 1123 |
| 7926 | 1090 |
| 7927 | 1068 |
| 7928 | 1220 |
| 7929 | 1240 |
| 7930 | 1283 |
| 7931 | 1224 |
| 7932 | 1228 |
| 7933 | 1227 |
| 7934 | 1220 |
| 7935 | 1252 |
| 7936 | 1287 |
| 7937 | 1344 |
| 7938 | 1382 |
| 7939 | 1444 |
| 7940 | 1548 |
| 7941 | 1574 |
| 7942 | 1630 |
| 7943 | 1709 |
| 7944 | 1775 |
| 7945 | 1856 |
| 7946 | 1946 |
| 7947 | 2045 |
| 7948 | 2138 |
| 7949 | 2132 |
| 7950 | 2102 |
| 7951 | 2059 |
| 7952 | 2002 |
| 7953 | 1924 |
| 7954 | 1854 |
| 7955 | 1805 |
| 7956 | 1774 |
| 7957 | 1723 |
| 7958 | 1722 |
| 7959 | 1682 |
| 7960 | 1590 |
| 7961 | 1504 |
| 7962 | 1421 |
| 7963 | 1342 |
| 7964 | 1252 |
| 7965 | 1183 |
| 7966 | 1126 |
| 7967 | 1071 |
| 7968 | 1036 |
| 7969 | 1030 |
| 7970 | 997 |
| 7971 | 971 |
| 7972 | 951 |
| 7973 | 927 |
| 7974 | 904 |
| 7975 | 884 |
| 7976 | 869 |
| 7977 | 858 |
| 7978 | 851 |
| 7979 | 842 |
| 7980 | 849 |
| 7981 | 856 |
| 7982 | 862 |
| 7983 | 872 |
| 7984 | 906 |
| 7985 | 921 |
| 7986 | 937 |
| 7987 | 958 |
| 7988 | 999 |
| 7989 | 1022 |
| 7990 | 1067 |
| 7991 | 1119 |
| 7992 | 1199 |
| 7993 | 1250 |
| 7994 | 1285 |
| 7995 | 1299 |
| 7996 | 1332 |
| 7997 | 1336 |
| 7998 | 1331 |
| 7999 | 1316 |
| 8000 | 1298 |
| 8001 | 1247 |
| 8002 | 1200 |
| 8003 | 1140 |
| 8004 | 1074 |
| 8005 | 1023 |
| 8006 | 995 |
| 8007 | 964 |
| 8008 | 925 |
| 8009 | 876 |
| 8010 | 844 |
| 8011 | 820 |
| 8012 | 823 |
| 8013 | 840 |
| 8014 | 864 |
| 8015 | 869 |
| 8016 | 874 |
| 8017 | 832 |
| 8018 | 786 |
| 8019 | 804 |
| 8020 | 883 |
| 8021 | 950 |
| 8022 | 923 |
| 8023 | 967 |
| 8024 | 1028 |
| 8025 | 1029 |
| 8026 | 1069 |
| 8027 | 1091 |
| 8028 | 1107 |
| 8029 | 1143 |
| 8030 | 1177 |
| 8031 | 1211 |
| 8032 | 1251 |
| 8033 | 1303 |
| 8034 | 1370 |
| 8035 | 1432 |
| 8036 | 1514 |
| 8037 | 1583 |
| 8038 | 1644 |
| 8039 | 1691 |
| 8040 | 1742 |
| 8041 | 1796 |
| 8042 | 1867 |
| 8043 | 1945 |
| 8044 | 2025 |
| 8045 | 2047 |
| 8046 | 2026 |
| 8047 | 1999 |
| 8048 | 1950 |
| 8049 | 1896 |
| 8050 | 1823 |
| 8051 | 1770 |
| 8052 | 1748 |
| 8053 | 1707 |
| 8054 | 1703 |
| 8055 | 1673 |
| 8056 | 1586 |
| 8057 | 1524 |
| 8058 | 1462 |
| 8059 | 1389 |
| 8060 | 1308 |
| 8061 | 1246 |
| 8062 | 1178 |
| 8063 | 1125 |
| 8064 | 1157 |
| 8065 | 1157 |
| 8066 | 1110 |
| 8067 | 1071 |
| 8068 | 1039 |
| 8069 | 1008 |
| 8070 | 979 |
| 8071 | 948 |
| 8072 | 931 |
| 8073 | 913 |
| 8074 | 891 |
| 8075 | 880 |
| 8076 | 871 |
| 8077 | 869 |
| 8078 | 856 |
| 8079 | 854 |
| 8080 | 864 |
| 8081 | 855 |
| 8082 | 851 |
| 8083 | 852 |
| 8084 | 861 |
| 8085 | 856 |
| 8086 | 854 |
| 8087 | 845 |
| 8088 | 877 |
| 8089 | 868 |
| 8090 | 885 |
| 8091 | 889 |
| 8092 | 925 |
| 8093 | 956 |
| 8094 | 990 |
| 8095 | 1039 |
| 8096 | 1107 |
| 8097 | 1149 |
| 8098 | 1191 |
| 8099 | 1228 |
| 8100 | 1252 |
| 8101 | 1299 |
| 8102 | 1341 |
| 8103 | 1371 |
| 8104 | 1367 |
| 8105 | 1338 |
| 8106 | 1335 |
| 8107 | 1385 |
| 8108 | 1449 |
| 8109 | 1545 |
| 8110 | 1626 |
| 8111 | 1622 |
| 8112 | 1566 |
| 8113 | 1504 |
| 8114 | 1457 |
| 8115 | 1417 |
| 8116 | 1382 |
| 8117 | 1364 |
| 8118 | 1307 |
| 8119 | 1239 |
| 8120 | 1215 |
| 8121 | 1235 |
| 8122 | 1198 |
| 8123 | 1209 |
| 8124 | 1172 |
| 8125 | 1227 |
| 8126 | 1266 |
| 8127 | 1267 |
| 8128 | 1247 |
| 8129 | 1272 |
| 8130 | 1308 |
| 8131 | 1364 |
| 8132 | 1398 |
| 8133 | 1433 |
| 8134 | 1494 |
| 8135 | 1558 |
| 8136 | 1607 |
| 8137 | 1672 |
| 8138 | 1759 |
| 8139 | 1827 |
| 8140 | 1919 |
| 8141 | 1934 |
| 8142 | 1927 |
| 8143 | 1898 |
| 8144 | 1855 |
| 8145 | 1772 |
| 8146 | 1703 |
| 8147 | 1646 |
| 8148 | 1644 |
| 8149 | 1617 |
| 8150 | 1624 |
| 8151 | 1614 |
| 8152 | 1541 |
| 8153 | 1465 |
| 8154 | 1384 |
| 8155 | 1311 |
| 8156 | 1238 |
| 8157 | 1160 |
| 8158 | 1101 |
| 8159 | 1040 |
| 8160 | 993 |
| 8161 | 982 |
| 8162 | 941 |
| 8163 | 906 |
| 8164 | 883 |
| 8165 | 862 |
| 8166 | 843 |
| 8167 | 822 |
| 8168 | 807 |
| 8169 | 792 |
| 8170 | 784 |
| 8171 | 781 |
| 8172 | 789 |
| 8173 | 783 |
| 8174 | 781 |
| 8175 | 782 |
| 8176 | 804 |
| 8177 | 800 |
| 8178 | 803 |
| 8179 | 805 |
| 8180 | 827 |
| 8181 | 829 |
| 8182 | 842 |
| 8183 | 825 |
| 8184 | 866 |
| 8185 | 886 |
| 8186 | 893 |
| 8187 | 909 |
| 8188 | 945 |
| 8189 | 973 |
| 8190 | 985 |
| 8191 | 1002 |
| 8192 | 1026 |
| 8193 | 1034 |
| 8194 | 1039 |
| 8195 | 1023 |
| 8196 | 1009 |
| 8197 | 999 |
| 8198 | 978 |
| 8199 | 952 |
| 8200 | 927 |
| 8201 | 923 |
| 8202 | 906 |
| 8203 | 891 |
| 8204 | 883 |
| 8205 | 888 |
| 8206 | 897 |
| 8207 | 892 |
| 8208 | 859 |
| 8209 | 832 |
| 8210 | 808 |
| 8211 | 784 |
| 8212 | 756 |
| 8213 | 755 |
| 8214 | 758 |
| 8215 | 727 |
| 8216 | 745 |
| 8217 | 757 |
| 8218 | 800 |
| 8219 | 815 |
| 8220 | 842 |
| 8221 | 841 |
| 8222 | 863 |
| 8223 | 895 |
| 8224 | 925 |
| 8225 | 974 |
| 8226 | 1018 |
| 8227 | 1089 |
| 8228 | 1163 |
| 8229 | 1251 |
| 8230 | 1316 |
| 8231 | 1370 |
| 8232 | 1426 |
| 8233 | 1489 |
| 8234 | 1533 |
| 8235 | 1598 |
| 8236 | 1675 |
| 8237 | 1713 |
| 8238 | 1691 |
| 8239 | 1673 |
| 8240 | 1632 |
| 8241 | 1564 |
| 8242 | 1509 |
| 8243 | 1458 |
| 8244 | 1447 |
| 8245 | 1416 |
| 8246 | 1416 |
| 8247 | 1399 |
| 8248 | 1337 |
| 8249 | 1282 |
| 8250 | 1227 |
| 8251 | 1181 |
| 8252 | 1127 |
| 8253 | 1067 |
| 8254 | 1009 |
| 8255 | 964 |
| 8256 | 843 |
| 8257 | 830 |
| 8258 | 799 |
| 8259 | 772 |
| 8260 | 752 |
| 8261 | 728 |
| 8262 | 706 |
| 8263 | 694 |
| 8264 | 0 |
| 8265 | 0 |
| 8266 | 0 |
| 8267 | 0 |
| 8268 | 668 |
| 8269 | 659 |
| 8270 | 655 |
| 8271 | 650 |
| 8272 | 649 |
| 8273 | 648 |
| 8274 | 654 |
| 8275 | 658 |
| 8276 | 666 |
| 8277 | 659 |
| 8278 | 660 |
| 8279 | 647 |
| 8280 | 663 |
| 8281 | 670 |
| 8282 | 677 |
| 8283 | 670 |
| 8284 | 686 |
| 8285 | 696 |
| 8286 | 705 |
| 8287 | 709 |
| 8288 | 728 |
| 8289 | 744 |
| 8290 | 766 |
| 8291 | 778 |
| 8292 | 775 |
| 8293 | 774 |
| 8294 | 770 |
| 8295 | 756 |
| 8296 | 725 |
| 8297 | 693 |
| 8298 | 666 |
| 8299 | 642 |
| 8300 | 629 |
| 8301 | 620 |
| 8302 | 629 |
| 8303 | 615 |
| 8304 | 577 |
| 8305 | 536 |
| 8306 | 517 |
| 8307 | 446 |
| 8308 | 411 |
| 8309 | 374 |
| 8310 | 353 |
| 8311 | 332 |
| 8312 | 311 |
| 8313 | 282 |
| 8314 | 285 |
| 8315 | 276 |
| 8316 | 271 |
| 8317 | 278 |
| 8318 | 311 |
| 8319 | 358 |
| 8320 | 439 |
| 8321 | 513 |
| 8322 | 551 |
| 8323 | 601 |
| 8324 | 720 |
| 8325 | 793 |
| 8326 | 856 |
| 8327 | 908 |
| 8328 | 965 |
| 8329 | 1030 |
| 8330 | 1071 |
| 8331 | 1118 |
| 8332 | 1159 |
| 8333 | 1188 |
| 8334 | 1220 |
| 8335 | 1255 |
| 8336 | 1303 |
| 8337 | 1320 |
| 8338 | 1297 |
| 8339 | 1261 |
| 8340 | 1240 |
| 8341 | 1211 |
| 8342 | 1209 |
| 8343 | 1185 |
| 8344 | 1134 |
| 8345 | 1071 |
| 8346 | 1007 |
| 8347 | 945 |
| 8348 | 885 |
| 8349 | 827 |
| 8350 | 777 |
| 8351 | 736 |
| 8352 | 906 |
| 8353 | 891 |
| 8354 | 856 |
| 8355 | 826 |
| 8356 | 804 |
| 8357 | 778 |
| 8358 | 754 |
| 8359 | 740 |
| 8360 | 763 |
| 8361 | 744 |
| 8362 | 729 |
| 8363 | 716 |
| 8364 | 707 |
| 8365 | 700 |
| 8366 | 696 |
| 8367 | 693 |
| 8368 | 694 |
| 8369 | 693 |
| 8370 | 699 |
| 8371 | 703 |
| 8372 | 713 |
| 8373 | 705 |
| 8374 | 707 |
| 8375 | 696 |
| 8376 | 716 |
| 8377 | 720 |
| 8378 | 722 |
| 8379 | 719 |
| 8380 | 739 |
| 8381 | 750 |
| 8382 | 762 |
| 8383 | 768 |
| 8384 | 792 |
| 8385 | 806 |
| 8386 | 824 |
| 8387 | 840 |
| 8388 | 844 |
| 8389 | 840 |
| 8390 | 841 |
| 8391 | 822 |
| 8392 | 784 |
| 8393 | 745 |
| 8394 | 714 |
| 8395 | 685 |
| 8396 | 670 |
| 8397 | 669 |
| 8398 | 674 |
| 8399 | 656 |
| 8400 | 611 |
| 8401 | 568 |
| 8402 | 559 |
| 8403 | 492 |
| 8404 | 451 |
| 8405 | 416 |
| 8406 | 393 |
| 8407 | 371 |
| 8408 | 358 |
| 8409 | 339 |
| 8410 | 336 |
| 8411 | 332 |
| 8412 | 334 |
| 8413 | 343 |
| 8414 | 383 |
| 8415 | 432 |
| 8416 | 522 |
| 8417 | 607 |
| 8418 | 645 |
| 8419 | 688 |
| 8420 | 802 |
| 8421 | 882 |
| 8422 | 947 |
| 8423 | 1004 |
| 8424 | 1065 |
| 8425 | 1128 |
| 8426 | 1170 |
| 8427 | 1216 |
| 8428 | 1256 |
| 8429 | 1282 |
| 8430 | 1310 |
| 8431 | 1342 |
| 8432 | 1385 |
| 8433 | 1405 |
| 8434 | 1393 |
| 8435 | 1360 |
| 8436 | 1337 |
| 8437 | 1305 |
| 8438 | 1301 |
| 8439 | 1280 |
| 8440 | 1223 |
| 8441 | 1155 |
| 8442 | 1086 |
| 8443 | 1021 |
| 8444 | 954 |
| 8445 | 892 |
| 8446 | 839 |
| 8447 | 795 |
| 8448 | 945 |
| 8449 | 929 |
| 8450 | 894 |
| 8451 | 866 |
| 8452 | 844 |
| 8453 | 831 |
| 8454 | 815 |
| 8455 | 796 |
| 8456 | 780 |
| 8457 | 772 |
| 8458 | 763 |
| 8459 | 760 |
| 8460 | 767 |
| 8461 | 772 |
| 8462 | 775 |
| 8463 | 779 |
| 8464 | 812 |
| 8465 | 829 |
| 8466 | 851 |
| 8467 | 881 |
| 8468 | 926 |
| 8469 | 952 |
| 8470 | 1005 |
| 8471 | 1068 |
| 8472 | 1206 |
| 8473 | 1295 |
| 8474 | 1352 |
| 8475 | 1398 |
| 8476 | 1460 |
| 8477 | 1481 |
| 8478 | 1500 |
| 8479 | 1531 |
| 8480 | 1584 |
| 8481 | 1601 |
| 8482 | 1614 |
| 8483 | 1613 |
| 8484 | 1555 |
| 8485 | 1540 |
| 8486 | 1540 |
| 8487 | 1506 |
| 8488 | 1423 |
| 8489 | 1355 |
| 8490 | 1304 |
| 8491 | 1258 |
| 8492 | 1237 |
| 8493 | 1257 |
| 8494 | 1281 |
| 8495 | 1313 |
| 8496 | 1288 |
| 8497 | 1286 |
| 8498 | 1223 |
| 8499 | 1148 |
| 8500 | 1111 |
| 8501 | 1114 |
| 8502 | 1103 |
| 8503 | 1131 |
| 8504 | 1137 |
| 8505 | 1088 |
| 8506 | 1106 |
| 8507 | 1153 |
| 8508 | 1209 |
| 8509 | 1268 |
| 8510 | 1276 |
| 8511 | 1298 |
| 8512 | 1316 |
| 8513 | 1338 |
| 8514 | 1344 |
| 8515 | 1352 |
| 8516 | 1362 |
| 8517 | 1362 |
| 8518 | 1377 |
| 8519 | 1408 |
| 8520 | 1438 |
| 8521 | 1469 |
| 8522 | 1498 |
| 8523 | 1522 |
| 8524 | 1567 |
| 8525 | 1623 |
| 8526 | 1682 |
| 8527 | 1742 |
| 8528 | 1799 |
| 8529 | 1860 |
| 8530 | 1852 |
| 8531 | 1806 |
| 8532 | 1767 |
| 8533 | 1711 |
| 8534 | 1686 |
| 8535 | 1644 |
| 8536 | 1558 |
| 8537 | 1466 |
| 8538 | 1374 |
| 8539 | 1292 |
| 8540 | 1195 |
| 8541 | 1124 |
| 8542 | 1064 |
| 8543 | 1013 |
| 8544 | 988 |
| 8545 | 977 |
| 8546 | 939 |
| 8547 | 908 |
| 8548 | 889 |
| 8549 | 875 |
| 8550 | 858 |
| 8551 | 845 |
| 8552 | 836 |
| 8553 | 831 |
| 8554 | 826 |
| 8555 | 823 |
| 8556 | 827 |
| 8557 | 825 |
| 8558 | 826 |
| 8559 | 833 |
| 8560 | 854 |
| 8561 | 865 |
| 8562 | 887 |
| 8563 | 913 |
| 8564 | 958 |
| 8565 | 979 |
| 8566 | 1027 |
| 8567 | 1091 |
| 8568 | 1226 |
| 8569 | 1314 |
| 8570 | 1354 |
| 8571 | 1367 |
| 8572 | 1431 |
| 8573 | 1460 |
| 8574 | 1479 |
| 8575 | 1491 |
| 8576 | 1482 |
| 8577 | 1443 |
| 8578 | 1426 |
| 8579 | 1393 |
| 8580 | 1300 |
| 8581 | 1232 |
| 8582 | 1189 |
| 8583 | 1150 |
| 8584 | 1114 |
| 8585 | 1070 |
| 8586 | 1015 |
| 8587 | 994 |
| 8588 | 983 |
| 8589 | 987 |
| 8590 | 1026 |
| 8591 | 1020 |
| 8592 | 979 |
| 8593 | 912 |
| 8594 | 860 |
| 8595 | 850 |
| 8596 | 832 |
| 8597 | 824 |
| 8598 | 836 |
| 8599 | 824 |
| 8600 | 793 |
| 8601 | 825 |
| 8602 | 870 |
| 8603 | 907 |
| 8604 | 933 |
| 8605 | 950 |
| 8606 | 974 |
| 8607 | 952 |
| 8608 | 998 |
| 8609 | 1033 |
| 8610 | 1031 |
| 8611 | 1076 |
| 8612 | 1158 |
| 8613 | 1276 |
| 8614 | 1356 |
| 8615 | 1374 |
| 8616 | 1405 |
| 8617 | 1456 |
| 8618 | 1522 |
| 8619 | 1557 |
| 8620 | 1588 |
| 8621 | 1618 |
| 8622 | 1656 |
| 8623 | 1712 |
| 8624 | 1763 |
| 8625 | 1829 |
| 8626 | 1822 |
| 8627 | 1784 |
| 8628 | 1753 |
| 8629 | 1695 |
| 8630 | 1666 |
| 8631 | 1621 |
| 8632 | 1525 |
| 8633 | 1442 |
| 8634 | 1367 |
| 8635 | 1282 |
| 8636 | 1182 |
| 8637 | 1101 |
| 8638 | 1035 |
| 8639 | 982 |
| 8640 | 973 |
| 8641 | 952 |
| 8642 | 918 |
| 8643 | 892 |
| 8644 | 863 |
| 8645 | 848 |
| 8646 | 835 |
| 8647 | 819 |
| 8648 | 809 |
| 8649 | 801 |
| 8650 | 796 |
| 8651 | 789 |
| 8652 | 793 |
| 8653 | 787 |
| 8654 | 790 |
| 8655 | 791 |
| 8656 | 815 |
| 8657 | 826 |
| 8658 | 862 |
| 8659 | 890 |
| 8660 | 940 |
| 8661 | 960 |
| 8662 | 1007 |
| 8663 | 1065 |
| 8664 | 1203 |
| 8665 | 1287 |
| 8666 | 1337 |
| 8667 | 1361 |
| 8668 | 1433 |
| 8669 | 1453 |
| 8670 | 1457 |
| 8671 | 1454 |
| 8672 | 1462 |
| 8673 | 1463 |
| 8674 | 1446 |
| 8675 | 1416 |
| 8676 | 1363 |
| 8677 | 1346 |
| 8678 | 1343 |
| 8679 | 1361 |
| 8680 | 1329 |
| 8681 | 1264 |
| 8682 | 1217 |
| 8683 | 1202 |
| 8684 | 1203 |
| 8685 | 1204 |
| 8686 | 1170 |
| 8687 | 1120 |
| 8688 | 1122 |
| 8689 | 1133 |
| 8690 | 1138 |
| 8691 | 1187 |
| 8692 | 1253 |
| 8693 | 1264 |
| 8694 | 1267 |
| 8695 | 1293 |
| 8696 | 1302 |
| 8697 | 1284 |
| 8698 | 1296 |
| 8699 | 1321 |
| 8700 | 1341 |
| 8701 | 1346 |
| 8702 | 1336 |
| 8703 | 1296 |
| 8704 | 1261 |
| 8705 | 1278 |
| 8706 | 1302 |
| 8707 | 1325 |
| 8708 | 1369 |
| 8709 | 1413 |
| 8710 | 1473 |
| 8711 | 1511 |
| 8712 | 1532 |
| 8713 | 1550 |
| 8714 | 1574 |
| 8715 | 1610 |
| 8716 | 1632 |
| 8717 | 1646 |
| 8718 | 1686 |
| 8719 | 1735 |
| 8720 | 1775 |
| 8721 | 1826 |
| 8722 | 1816 |
| 8723 | 1774 |
| 8724 | 1732 |
| 8725 | 1673 |
| 8726 | 1646 |
| 8727 | 1630 |
| 8728 | 1530 |
| 8729 | 1442 |
| 8730 | 1355 |
| 8731 | 1271 |
| 8732 | 1185 |
| 8733 | 1110 |
| 8734 | 1044 |
| 8735 | 991 |
| 8736 | 985 |
| 8737 | 966 |
| 8738 | 935 |
| 8739 | 905 |
| 8740 | 884 |
| 8741 | 866 |
| 8742 | 848 |
| 8743 | 831 |
| 8744 | 820 |
| 8745 | 810 |
| 8746 | 801 |
| 8747 | 799 |
| 8748 | 806 |
| 8749 | 804 |
| 8750 | 805 |
| 8751 | 810 |
| 8752 | 830 |
| 8753 | 837 |
| 8754 | 859 |
| 8755 | 891 |
| 8756 | 934 |
| 8757 | 957 |
| 8758 | 1002 |
| 8759 | 1071 |
| 8760 | 1198 |
| 8761 | 1286 |
| 8762 | 1342 |
| 8763 | 1367 |
| 8764 | 1444 |
| 8765 | 1473 |
| 8766 | 1481 |
| 8767 | 1507 |
| 8768 | 1545 |
| 8769 | 1539 |
| 8770 | 1529 |
| 8771 | 1519 |
| 8772 | 1484 |
| 8773 | 1470 |
| 8774 | 1462 |
| 8775 | 1415 |
| 8776 | 1348 |
| 8777 | 1301 |
| 8778 | 1283 |
| 8779 | 1281 |
| 8780 | 1256 |
| 8781 | 1214 |
| 8782 | 1196 |
| 8783 | 1206 |
| 8784 | 1152 |
| 8785 | 1072 |
| 8786 | 944 |
| 8787 | 899 |
| 8788 | 929 |
| 8789 | 936 |
| 8790 | 911 |
| 8791 | 886 |
| 8792 | 902 |
| 8793 | 976 |
| 8794 | 1040 |
| 8795 | 1039 |
| 8796 | 1030 |
| 8797 | 1049 |
| 8798 | 1100 |
| 8799 | 1129 |
| 8800 | 1124 |
| 8801 | 1112 |
| 8802 | 1149 |
| 8803 | 1194 |
| 8804 | 1262 |
| 8805 | 1305 |
| 8806 | 1355 |
| 8807 | 1404 |
| 8808 | 1468 |
| 8809 | 1517 |
| 8810 | 1562 |
| 8811 | 1600 |
| 8812 | 1610 |
| 8813 | 1604 |
| 8814 | 1622 |
| 8815 | 1666 |
| 8816 | 1703 |
| 8817 | 1761 |
| 8818 | 1740 |
| 8819 | 1700 |
| 8820 | 1669 |
| 8821 | 1627 |
| 8822 | 1609 |
| 8823 | 1589 |
| 8824 | 1526 |
| 8825 | 1456 |
| 8826 | 1389 |
| 8827 | 1323 |
| 8828 | 1244 |
| 8829 | 1175 |
| 8830 | 1119 |
| 8831 | 1058 |
| 8832 | 1042 |
| 8833 | 1019 |
| 8834 | 981 |
| 8835 | 942 |
| 8836 | 915 |
| 8837 | 893 |
| 8838 | 864 |
| 8839 | 848 |
| 8840 | 834 |
| 8841 | 823 |
| 8842 | 814 |
| 8843 | 808 |
| 8844 | 812 |
| 8845 | 808 |
| 8846 | 800 |
| 8847 | 802 |
| 8848 | 813 |
| 8849 | 816 |
| 8850 | 821 |
| 8851 | 828 |
| 8852 | 843 |
| 8853 | 846 |
| 8854 | 867 |
| 8855 | 877 |
| 8856 | 940 |
| 8857 | 965 |
| 8858 | 993 |
| 8859 | 1008 |
| 8860 | 1069 |
| 8861 | 1100 |
| 8862 | 1144 |
| 8863 | 1183 |
| 8864 | 1226 |
| 8865 | 1245 |
| 8866 | 1277 |
| 8867 | 1314 |
| 8868 | 1308 |
| 8869 | 1303 |
| 8870 | 1294 |
| 8871 | 1284 |
| 8872 | 1280 |
| 8873 | 1269 |
| 8874 | 1243 |
| 8875 | 1204 |
| 8876 | 1193 |
| 8877 | 1202 |
| 8878 | 1180 |
| 8879 | 1185 |
| 8880 | 1216 |
| 8881 | 1229 |
| 8882 | 1272 |
| 8883 | 1286 |
| 8884 | 1274 |
| 8885 | 1234 |
| 8886 | 1197 |
| 8887 | 1176 |
| 8888 | 1166 |
| 8889 | 1140 |
| 8890 | 1083 |
| 8891 | 1078 |
| 8892 | 1046 |
| 8893 | 1040 |
| 8894 | 1058 |
| 8895 | 1073 |
| 8896 | 1085 |
| 8897 | 1102 |
| 8898 | 1121 |
| 8899 | 1159 |
| 8900 | 1174 |
| 8901 | 1219 |
| 8902 | 1298 |
| 8903 | 1403 |
| 8904 | 1458 |
| 8905 | 1511 |
| 8906 | 1560 |
| 8907 | 1581 |
| 8908 | 1593 |
| 8909 | 1610 |
| 8910 | 1615 |
| 8911 | 1635 |
| 8912 | 1656 |
| 8913 | 1693 |
| 8914 | 1692 |
| 8915 | 1642 |
| 8916 | 1606 |
| 8917 | 1562 |
| 8918 | 1547 |
| 8919 | 1517 |
| 8920 | 1455 |
| 8921 | 1396 |
| 8922 | 1344 |
| 8923 | 1291 |
| 8924 | 1229 |
| 8925 | 1167 |
| 8926 | 1103 |
| 8927 | 1050 |
| 8928 | 1049 |
| 8929 | 1031 |
| 8930 | 989 |
| 8931 | 953 |
| 8932 | 927 |
| 8933 | 895 |
| 8934 | 868 |
| 8935 | 851 |
| 8936 | 863 |
| 8937 | 844 |
| 8938 | 829 |
| 8939 | 813 |
| 8940 | 806 |
| 8941 | 801 |
| 8942 | 797 |
| 8943 | 797 |
| 8944 | 799 |
| 8945 | 800 |
| 8946 | 805 |
| 8947 | 810 |
| 8948 | 822 |
| 8949 | 814 |
| 8950 | 817 |
| 8951 | 807 |
| 8952 | 835 |
| 8953 | 834 |
| 8954 | 832 |
| 8955 | 832 |
| 8956 | 859 |
| 8957 | 871 |
| 8958 | 888 |
| 8959 | 897 |
| 8960 | 929 |
| 8961 | 942 |
| 8962 | 956 |
| 8963 | 979 |
| 8964 | 991 |
| 8965 | 983 |
| 8966 | 991 |
| 8967 | 963 |
| 8968 | 914 |
| 8969 | 865 |
| 8970 | 825 |
| 8971 | 789 |
| 8972 | 769 |
| 8973 | 779 |
| 8974 | 780 |
| 8975 | 754 |
| 8976 | 697 |
| 8977 | 649 |
| 8978 | 653 |
| 8979 | 587 |
| 8980 | 534 |
| 8981 | 500 |
| 8982 | 471 |
| 8983 | 447 |
| 8984 | 442 |
| 8985 | 435 |
| 8986 | 425 |
| 8987 | 428 |
| 8988 | 437 |
| 8989 | 451 |
| 8990 | 502 |
| 8991 | 558 |
| 8992 | 665 |
| 8993 | 769 |
| 8994 | 810 |
| 8995 | 846 |
| 8996 | 963 |
| 8997 | 1057 |
| 8998 | 1130 |
| 8999 | 1198 |
| 9000 | 1266 |
| 9001 | 1332 |
| 9002 | 1377 |
| 9003 | 1427 |
| 9004 | 1467 |
| 9005 | 1491 |
| 9006 | 1518 |
| 9007 | 1548 |
| 9008 | 1588 |
| 9009 | 1611 |
| 9010 | 1613 |
| 9011 | 1581 |
| 9012 | 1555 |
| 9013 | 1518 |
| 9014 | 1509 |
| 9015 | 1490 |
| 9016 | 1422 |
| 9017 | 1343 |
| 9018 | 1264 |
| 9019 | 1188 |
| 9020 | 1109 |
| 9021 | 1037 |
| 9022 | 977 |
| 9023 | 926 |
| 9024 | 930 |
| 9025 | 913 |
| 9026 | 881 |
| 9027 | 853 |
| 9028 | 830 |
| 9029 | 815 |
| 9030 | 798 |
| 9031 | 781 |
| 9032 | 764 |
| 9033 | 755 |
| 9034 | 744 |
| 9035 | 740 |
| 9036 | 746 |
| 9037 | 746 |
| 9038 | 749 |
| 9039 | 756 |
| 9040 | 791 |
| 9041 | 809 |
| 9042 | 833 |
| 9043 | 863 |
| 9044 | 905 |
| 9045 | 927 |
| 9046 | 976 |
| 9047 | 1036 |
| 9048 | 1160 |
| 9049 | 1235 |
| 9050 | 1272 |
| 9051 | 1317 |
| 9052 | 1400 |
| 9053 | 1435 |
| 9054 | 1461 |
| 9055 | 1493 |
| 9056 | 1553 |
| 9057 | 1576 |
| 9058 | 1599 |
| 9059 | 1601 |
| 9060 | 1571 |
| 9061 | 1561 |
| 9062 | 1529 |
| 9063 | 1453 |
| 9064 | 1293 |
| 9065 | 1245 |
| 9066 | 1319 |
| 9067 | 1318 |
| 9068 | 1251 |
| 9069 | 1203 |
| 9070 | 1153 |
| 9071 | 1137 |
| 9072 | 1154 |
| 9073 | 1154 |
| 9074 | 1111 |
| 9075 | 1090 |
| 9076 | 1004 |
| 9077 | 987 |
| 9078 | 1003 |
| 9079 | 1083 |
| 9080 | 1117 |
| 9081 | 1057 |
| 9082 | 1067 |
| 9083 | 1125 |
| 9084 | 1144 |
| 9085 | 1131 |
| 9086 | 1244 |
| 9087 | 1217 |
| 9088 | 1210 |
| 9089 | 1191 |
| 9090 | 1271 |
| 9091 | 1293 |
| 9092 | 1285 |
| 9093 | 1302 |
| 9094 | 1389 |
| 9095 | 1405 |
| 9096 | 1426 |
| 9097 | 1490 |
| 9098 | 1540 |
| 9099 | 1569 |
| 9100 | 1594 |
| 9101 | 1629 |
| 9102 | 1650 |
| 9103 | 1705 |
| 9104 | 1746 |
| 9105 | 1788 |
| 9106 | 1806 |
| 9107 | 1775 |
| 9108 | 1739 |
| 9109 | 1685 |
| 9110 | 1658 |
| 9111 | 1618 |
| 9112 | 1531 |
| 9113 | 1448 |
| 9114 | 1360 |
| 9115 | 1280 |
| 9116 | 1187 |
| 9117 | 1115 |
| 9118 | 1053 |
| 9119 | 1006 |
| 9120 | 998 |
| 9121 | 981 |
| 9122 | 950 |
| 9123 | 920 |
| 9124 | 903 |
| 9125 | 880 |
| 9126 | 866 |
| 9127 | 848 |
| 9128 | 836 |
| 9129 | 824 |
| 9130 | 817 |
| 9131 | 807 |
| 9132 | 812 |
| 9133 | 809 |
| 9134 | 808 |
| 9135 | 805 |
| 9136 | 828 |
| 9137 | 838 |
| 9138 | 863 |
| 9139 | 889 |
| 9140 | 931 |
| 9141 | 952 |
| 9142 | 994 |
| 9143 | 1051 |
| 9144 | 1177 |
| 9145 | 1243 |
| 9146 | 1285 |
| 9147 | 1322 |
| 9148 | 1404 |
| 9149 | 1421 |
| 9150 | 1432 |
| 9151 | 1441 |
| 9152 | 1473 |
| 9153 | 1505 |
| 9154 | 1507 |
| 9155 | 1502 |
| 9156 | 1453 |
| 9157 | 1428 |
| 9158 | 1396 |
| 9159 | 1376 |
| 9160 | 1329 |
| 9161 | 1267 |
| 9162 | 1195 |
| 9163 | 1171 |
| 9164 | 1127 |
| 9165 | 1143 |
| 9166 | 1141 |
| 9167 | 1110 |
| 9168 | 1149 |
| 9169 | 1109 |
| 9170 | 1055 |
| 9171 | 1045 |
| 9172 | 1075 |
| 9173 | 1111 |
| 9174 | 1086 |
| 9175 | 1051 |
| 9176 | 1059 |
| 9177 | 1138 |
| 9178 | 1155 |
| 9179 | 1175 |
| 9180 | 1179 |
| 9181 | 1129 |
| 9182 | 1131 |
| 9183 | 1220 |
| 9184 | 1242 |
| 9185 | 1248 |
| 9186 | 1279 |
| 9187 | 1323 |
| 9188 | 1352 |
| 9189 | 1425 |
| 9190 | 1489 |
| 9191 | 1529 |
| 9192 | 1567 |
| 9193 | 1608 |
| 9194 | 1617 |
| 9195 | 1654 |
| 9196 | 1694 |
| 9197 | 1712 |
| 9198 | 1724 |
| 9199 | 1740 |
| 9200 | 1766 |
| 9201 | 1810 |
| 9202 | 1812 |
| 9203 | 1783 |
| 9204 | 1751 |
| 9205 | 1704 |
| 9206 | 1663 |
| 9207 | 1640 |
| 9208 | 1545 |
| 9209 | 1470 |
| 9210 | 1390 |
| 9211 | 1300 |
| 9212 | 1214 |
| 9213 | 1140 |
| 9214 | 1077 |
| 9215 | 1025 |
| 9216 | 1017 |
| 9217 | 1008 |
| 9218 | 972 |
| 9219 | 943 |
| 9220 | 924 |
| 9221 | 908 |
| 9222 | 890 |
| 9223 | 877 |
| 9224 | 866 |
| 9225 | 858 |
| 9226 | 857 |
| 9227 | 854 |
| 9228 | 860 |
| 9229 | 856 |
| 9230 | 855 |
| 9231 | 861 |
| 9232 | 885 |
| 9233 | 894 |
| 9234 | 912 |
| 9235 | 941 |
| 9236 | 983 |
| 9237 | 1000 |
| 9238 | 1047 |
| 9239 | 1099 |
| 9240 | 1214 |
| 9241 | 1276 |
| 9242 | 1309 |
| 9243 | 1337 |
| 9244 | 1399 |
| 9245 | 1422 |
| 9246 | 1440 |
| 9247 | 1444 |
| 9248 | 1434 |
| 9249 | 1401 |
| 9250 | 1382 |
| 9251 | 1342 |
| 9252 | 1253 |
| 9253 | 1192 |
| 9254 | 1150 |
| 9255 | 1112 |
| 9256 | 1075 |
| 9257 | 1035 |
| 9258 | 989 |
| 9259 | 982 |
| 9260 | 978 |
| 9261 | 1012 |
| 9262 | 1083 |
| 9263 | 1071 |
| 9264 | 1036 |
| 9265 | 986 |
| 9266 | 945 |
| 9267 | 925 |
| 9268 | 903 |
| 9269 | 920 |
| 9270 | 922 |
| 9271 | 894 |
| 9272 | 872 |
| 9273 | 928 |
| 9274 | 929 |
| 9275 | 937 |
| 9276 | 929 |
| 9277 | 969 |
| 9278 | 949 |
| 9279 | 962 |
| 9280 | 1030 |
| 9281 | 1040 |
| 9282 | 1058 |
| 9283 | 1105 |
| 9284 | 1154 |
| 9285 | 1245 |
| 9286 | 1340 |
| 9287 | 1367 |
| 9288 | 1412 |
| 9289 | 1471 |
| 9290 | 1512 |
| 9291 | 1556 |
| 9292 | 1596 |
| 9293 | 1617 |
| 9294 | 1649 |
| 9295 | 1696 |
| 9296 | 1737 |
| 9297 | 1787 |
| 9298 | 1800 |
| 9299 | 1790 |
| 9300 | 1761 |
| 9301 | 1714 |
| 9302 | 1683 |
| 9303 | 1643 |
| 9304 | 1545 |
| 9305 | 1465 |
| 9306 | 1388 |
| 9307 | 1302 |
| 9308 | 1205 |
| 9309 | 1127 |
| 9310 | 1057 |
| 9311 | 1000 |
| 9312 | 966 |
| 9313 | 949 |
| 9314 | 917 |
| 9315 | 888 |
| 9316 | 861 |
| 9317 | 845 |
| 9318 | 829 |
| 9319 | 812 |
| 9320 | 803 |
| 9321 | 798 |
| 9322 | 794 |
| 9323 | 785 |
| 9324 | 789 |
| 9325 | 784 |
| 9326 | 787 |
| 9327 | 788 |
| 9328 | 814 |
| 9329 | 825 |
| 9330 | 856 |
| 9331 | 882 |
| 9332 | 933 |
| 9333 | 951 |
| 9334 | 997 |
| 9335 | 1053 |
| 9336 | 1172 |
| 9337 | 1252 |
| 9338 | 1285 |
| 9339 | 1320 |
| 9340 | 1390 |
| 9341 | 1406 |
| 9342 | 1419 |
| 9343 | 1413 |
| 9344 | 1438 |
| 9345 | 1444 |
| 9346 | 1436 |
| 9347 | 1418 |
| 9348 | 1374 |
| 9349 | 1359 |
| 9350 | 1355 |
| 9351 | 1354 |
| 9352 | 1328 |
| 9353 | 1291 |
| 9354 | 1256 |
| 9355 | 1240 |
| 9356 | 1248 |
| 9357 | 1242 |
| 9358 | 1190 |
| 9359 | 1165 |
| 9360 | 1188 |
| 9361 | 1154 |
| 9362 | 1119 |
| 9363 | 1104 |
| 9364 | 1173 |
| 9365 | 1161 |
| 9366 | 1158 |
| 9367 | 1221 |
| 9368 | 1246 |
| 9369 | 1239 |
| 9370 | 1247 |
| 9371 | 1263 |
| 9372 | 1295 |
| 9373 | 1308 |
| 9374 | 1306 |
| 9375 | 1289 |
| 9376 | 1276 |
| 9377 | 1285 |
| 9378 | 1298 |
| 9379 | 1314 |
| 9380 | 1362 |
| 9381 | 1417 |
| 9382 | 1467 |
| 9383 | 1508 |
| 9384 | 1526 |
| 9385 | 1536 |
| 9386 | 1572 |
| 9387 | 1612 |
| 9388 | 1628 |
| 9389 | 1634 |
| 9390 | 1665 |
| 9391 | 1705 |
| 9392 | 1737 |
| 9393 | 1773 |
| 9394 | 1766 |
| 9395 | 1742 |
| 9396 | 1718 |
| 9397 | 1665 |
| 9398 | 1640 |
| 9399 | 1622 |
| 9400 | 1525 |
| 9401 | 1436 |
| 9402 | 1352 |
| 9403 | 1269 |
| 9404 | 1185 |
| 9405 | 1112 |
| 9406 | 1046 |
| 9407 | 991 |
| 9408 | 985 |
| 9409 | 969 |
| 9410 | 937 |
| 9411 | 910 |
| 9412 | 886 |
| 9413 | 867 |
| 9414 | 849 |
| 9415 | 830 |
| 9416 | 819 |
| 9417 | 813 |
| 9418 | 804 |
| 9419 | 800 |
| 9420 | 807 |
| 9421 | 807 |
| 9422 | 808 |
| 9423 | 811 |
| 9424 | 830 |
| 9425 | 838 |
| 9426 | 857 |
| 9427 | 883 |
| 9428 | 926 |
| 9429 | 946 |
| 9430 | 995 |
| 9431 | 1055 |
| 9432 | 1167 |
| 9433 | 1242 |
| 9434 | 1283 |
| 9435 | 1320 |
| 9436 | 1392 |
| 9437 | 1418 |
| 9438 | 1426 |
| 9439 | 1451 |
| 9440 | 1492 |
| 9441 | 1494 |
| 9442 | 1485 |
| 9443 | 1473 |
| 9444 | 1441 |
| 9445 | 1420 |
| 9446 | 1410 |
| 9447 | 1367 |
| 9448 | 1290 |
| 9449 | 1248 |
| 9450 | 1228 |
| 9451 | 1214 |
| 9452 | 1177 |
| 9453 | 1109 |
| 9454 | 1082 |
| 9455 | 1080 |
| 9456 | 1016 |
| 9457 | 946 |
| 9458 | 853 |
| 9459 | 812 |
| 9460 | 823 |
| 9461 | 810 |
| 9462 | 792 |
| 9463 | 775 |
| 9464 | 809 |
| 9465 | 896 |
| 9466 | 929 |
| 9467 | 942 |
| 9468 | 948 |
| 9469 | 983 |
| 9470 | 1062 |
| 9471 | 1096 |
| 9472 | 1073 |
| 9473 | 1040 |
| 9474 | 1095 |
| 9475 | 1152 |
| 9476 | 1234 |
| 9477 | 1273 |
| 9478 | 1325 |
| 9479 | 1355 |
| 9480 | 1424 |
| 9481 | 1483 |
| 9482 | 1540 |
| 9483 | 1587 |
| 9484 | 1592 |
| 9485 | 1585 |
| 9486 | 1598 |
| 9487 | 1645 |
| 9488 | 1683 |
| 9489 | 1730 |
| 9490 | 1714 |
| 9491 | 1684 |
| 9492 | 1662 |
| 9493 | 1622 |
| 9494 | 1602 |
| 9495 | 1584 |
| 9496 | 1516 |
| 9497 | 1446 |
| 9498 | 1382 |
| 9499 | 1312 |
| 9500 | 1237 |
| 9501 | 1172 |
| 9502 | 1113 |
| 9503 | 1052 |
| 9504 | 1036 |
| 9505 | 1013 |
| 9506 | 977 |
| 9507 | 940 |
| 9508 | 913 |
| 9509 | 891 |
| 9510 | 863 |
| 9511 | 845 |
| 9512 | 828 |
| 9513 | 814 |
| 9514 | 807 |
| 9515 | 801 |
| 9516 | 806 |
| 9517 | 802 |
| 9518 | 796 |
| 9519 | 798 |
| 9520 | 808 |
| 9521 | 813 |
| 9522 | 819 |
| 9523 | 825 |
| 9524 | 841 |
| 9525 | 845 |
| 9526 | 869 |
| 9527 | 875 |
| 9528 | 929 |
| 9529 | 951 |
| 9530 | 970 |
| 9531 | 994 |
| 9532 | 1042 |
| 9533 | 1068 |
| 9534 | 1105 |
| 9535 | 1144 |
| 9536 | 1180 |
| 9537 | 1193 |
| 9538 | 1221 |
| 9539 | 1262 |
| 9540 | 1247 |
| 9541 | 1236 |
| 9542 | 1236 |
| 9543 | 1216 |
| 9544 | 1192 |
| 9545 | 1174 |
| 9546 | 1152 |
| 9547 | 1102 |
| 9548 | 1063 |
| 9549 | 1077 |
| 9550 | 1079 |
| 9551 | 1087 |
| 9552 | 1099 |
| 9553 | 1081 |
| 9554 | 1111 |
| 9555 | 1104 |
| 9556 | 1061 |
| 9557 | 1000 |
| 9558 | 1002 |
| 9559 | 998 |
| 9560 | 986 |
| 9561 | 978 |
| 9562 | 956 |
| 9563 | 982 |
| 9564 | 939 |
| 9565 | 887 |
| 9566 | 900 |
| 9567 | 919 |
| 9568 | 946 |
| 9569 | 968 |
| 9570 | 1000 |
| 9571 | 1045 |
| 9572 | 1089 |
| 9573 | 1130 |
| 9574 | 1216 |
| 9575 | 1331 |
| 9576 | 1384 |
| 9577 | 1444 |
| 9578 | 1520 |
| 9579 | 1555 |
| 9580 | 1579 |
| 9581 | 1603 |
| 9582 | 1607 |
| 9583 | 1618 |
| 9584 | 1634 |
| 9585 | 1650 |
| 9586 | 1654 |
| 9587 | 1620 |
| 9588 | 1594 |
| 9589 | 1551 |
| 9590 | 1529 |
| 9591 | 1504 |
| 9592 | 1440 |
| 9593 | 1380 |
| 9594 | 1332 |
| 9595 | 1279 |
| 9596 | 1214 |
| 9597 | 1157 |
| 9598 | 1094 |
| 9599 | 1042 |
| 9600 | 1024 |
| 9601 | 1003 |
| 9602 | 958 |
| 9603 | 920 |
| 9604 | 893 |
| 9605 | 862 |
| 9606 | 836 |
| 9607 | 817 |
| 9608 | 801 |
| 9609 | 786 |
| 9610 | 775 |
| 9611 | 762 |
| 9612 | 759 |
| 9613 | 758 |
| 9614 | 756 |
| 9615 | 762 |
| 9616 | 768 |
| 9617 | 768 |
| 9618 | 773 |
| 9619 | 778 |
| 9620 | 791 |
| 9621 | 780 |
| 9622 | 785 |
| 9623 | 784 |
| 9624 | 818 |
| 9625 | 800 |
| 9626 | 792 |
| 9627 | 802 |
| 9628 | 834 |
| 9629 | 854 |
| 9630 | 882 |
| 9631 | 900 |
| 9632 | 938 |
| 9633 | 952 |
| 9634 | 968 |
| 9635 | 1006 |
| 9636 | 1037 |
| 9637 | 1031 |
| 9638 | 1056 |
| 9639 | 1034 |
| 9640 | 986 |
| 9641 | 942 |
| 9642 | 904 |
| 9643 | 880 |
| 9644 | 862 |
| 9645 | 895 |
| 9646 | 893 |
| 9647 | 854 |
| 9648 | 801 |
| 9649 | 766 |
| 9650 | 784 |
| 9651 | 737 |
| 9652 | 696 |
| 9653 | 670 |
| 9654 | 643 |
| 9655 | 626 |
| 9656 | 625 |
| 9657 | 633 |
| 9658 | 613 |
| 9659 | 616 |
| 9660 | 626 |
| 9661 | 639 |
| 9662 | 698 |
| 9663 | 748 |
| 9664 | 854 |
| 9665 | 949 |
| 9666 | 972 |
| 9667 | 981 |
| 9668 | 1051 |
| 9669 | 1129 |
| 9670 | 1179 |
| 9671 | 1241 |
| 9672 | 1300 |
| 9673 | 1348 |
| 9674 | 1382 |
| 9675 | 1423 |
| 9676 | 1448 |
| 9677 | 1463 |
| 9678 | 1473 |
| 9679 | 1491 |
| 9680 | 1514 |
| 9681 | 1537 |
| 9682 | 1560 |
| 9683 | 1545 |
| 9684 | 1528 |
| 9685 | 1495 |
| 9686 | 1479 |
| 9687 | 1470 |
| 9688 | 1397 |
| 9689 | 1320 |
| 9690 | 1243 |
| 9691 | 1170 |
| 9692 | 1090 |
| 9693 | 1020 |
| 9694 | 964 |
| 9695 | 914 |
| 9696 | 914 |
| 9697 | 896 |
| 9698 | 866 |
| 9699 | 838 |
| 9700 | 817 |
| 9701 | 799 |
| 9702 | 780 |
| 9703 | 766 |
| 9704 | 749 |
| 9705 | 741 |
| 9706 | 728 |
| 9707 | 723 |
| 9708 | 729 |
| 9709 | 725 |
| 9710 | 729 |
| 9711 | 737 |
| 9712 | 771 |
| 9713 | 789 |
| 9714 | 814 |
| 9715 | 842 |
| 9716 | 886 |
| 9717 | 905 |
| 9718 | 953 |
| 9719 | 1012 |
| 9720 | 1117 |
| 9721 | 1181 |
| 9722 | 1206 |
| 9723 | 1254 |
| 9724 | 1350 |
| 9725 | 1393 |
| 9726 | 1424 |
| 9727 | 1454 |
| 9728 | 1519 |
| 9729 | 1546 |
| 9730 | 1576 |
| 9731 | 1581 |
| 9732 | 1567 |
| 9733 | 1558 |
| 9734 | 1519 |
| 9735 | 1434 |
| 9736 | 1252 |
| 9737 | 1226 |
| 9738 | 1361 |
| 9739 | 1381 |
| 9740 | 1291 |
| 9741 | 1212 |
| 9742 | 1133 |
| 9743 | 1095 |
| 9744 | 1136 |
| 9745 | 1136 |
| 9746 | 1096 |
| 9747 | 1111 |
| 9748 | 1002 |
| 9749 | 982 |
| 9750 | 1008 |
| 9751 | 1114 |
| 9752 | 1160 |
| 9753 | 1090 |
| 9754 | 1095 |
| 9755 | 1154 |
| 9756 | 1150 |
| 9757 | 1090 |
| 9758 | 1256 |
| 9759 | 1199 |
| 9760 | 1176 |
| 9761 | 1128 |
| 9762 | 1249 |
| 9763 | 1280 |
| 9764 | 1267 |
| 9765 | 1299 |
| 9766 | 1427 |
| 9767 | 1439 |
| 9768 | 1460 |
| 9769 | 1539 |
| 9770 | 1598 |
| 9771 | 1626 |
| 9772 | 1631 |
| 9773 | 1647 |
| 9774 | 1638 |
| 9775 | 1680 |
| 9776 | 1700 |
| 9777 | 1716 |
| 9778 | 1752 |
| 9779 | 1738 |
| 9780 | 1706 |
| 9781 | 1654 |
| 9782 | 1625 |
| 9783 | 1585 |
| 9784 | 1498 |
| 9785 | 1423 |
| 9786 | 1338 |
| 9787 | 1259 |
| 9788 | 1170 |
| 9789 | 1097 |
| 9790 | 1034 |
| 9791 | 990 |
| 9792 | 986 |
| 9793 | 970 |
| 9794 | 940 |
| 9795 | 912 |
| 9796 | 892 |
| 9797 | 870 |
| 9798 | 858 |
| 9799 | 841 |
| 9800 | 832 |
| 9801 | 822 |
| 9802 | 811 |
| 9803 | 801 |
| 9804 | 807 |
| 9805 | 804 |
| 9806 | 800 |
| 9807 | 796 |
| 9808 | 818 |
| 9809 | 828 |
| 9810 | 852 |
| 9811 | 876 |
| 9812 | 922 |
| 9813 | 942 |
| 9814 | 981 |
| 9815 | 1035 |
| 9816 | 1151 |
| 9817 | 1198 |
| 9818 | 1230 |
| 9819 | 1280 |
| 9820 | 1371 |
| 9821 | 1401 |
| 9822 | 1422 |
| 9823 | 1428 |
| 9824 | 1462 |
| 9825 | 1512 |
| 9826 | 1536 |
| 9827 | 1547 |
| 9828 | 1512 |
| 9829 | 1511 |
| 9830 | 1496 |
| 9831 | 1497 |
| 9832 | 1471 |
| 9833 | 1422 |
| 9834 | 1372 |
| 9835 | 1355 |
| 9836 | 1302 |
| 9837 | 1336 |
| 9838 | 1353 |
| 9839 | 1294 |
| 9840 | 1344 |
| 9841 | 1291 |
| 9842 | 1209 |
| 9843 | 1209 |
| 9844 | 1265 |
| 9845 | 1303 |
| 9846 | 1276 |
| 9847 | 1222 |
| 9848 | 1238 |
| 9849 | 1327 |
| 9850 | 1334 |
| 9851 | 1347 |
| 9852 | 1313 |
| 9853 | 1227 |
| 9854 | 1232 |
| 9855 | 1312 |
| 9856 | 1341 |
| 9857 | 1350 |
| 9858 | 1383 |
| 9859 | 1409 |
| 9860 | 1431 |
| 9861 | 1479 |
| 9862 | 1535 |
| 9863 | 1570 |
| 9864 | 1606 |
| 9865 | 1650 |
| 9866 | 1655 |
| 9867 | 1685 |
| 9868 | 1731 |
| 9869 | 1742 |
| 9870 | 1743 |
| 9871 | 1743 |
| 9872 | 1743 |
| 9873 | 1757 |
| 9874 | 1767 |
| 9875 | 1753 |
| 9876 | 1742 |
| 9877 | 1705 |
| 9878 | 1670 |
| 9879 | 1648 |
| 9880 | 1553 |
| 9881 | 1481 |
| 9882 | 1406 |
| 9883 | 1318 |
| 9884 | 1230 |
| 9885 | 1156 |
| 9886 | 1093 |
| 9887 | 1039 |
| 9888 | 1014 |
| 9889 | 1008 |
| 9890 | 973 |
| 9891 | 947 |
| 9892 | 925 |
| 9893 | 910 |
| 9894 | 892 |
| 9895 | 877 |
| 9896 | 862 |
| 9897 | 854 |
| 9898 | 851 |
| 9899 | 850 |
| 9900 | 857 |
| 9901 | 852 |
| 9902 | 849 |
| 9903 | 855 |
| 9904 | 884 |
| 9905 | 890 |
| 9906 | 908 |
| 9907 | 935 |
| 9908 | 976 |
| 9909 | 989 |
| 9910 | 1034 |
| 9911 | 1075 |
| 9912 | 1163 |
| 9913 | 1206 |
| 9914 | 1224 |
| 9915 | 1264 |
| 9916 | 1320 |
| 9917 | 1345 |
| 9918 | 1366 |
| 9919 | 1364 |
| 9920 | 1360 |
| 9921 | 1336 |
| 9922 | 1307 |
| 9923 | 1269 |
| 9924 | 1189 |
| 9925 | 1134 |
| 9926 | 1101 |
| 9927 | 1061 |
| 9928 | 1024 |
| 9929 | 989 |
| 9930 | 941 |
| 9931 | 945 |
| 9932 | 949 |
| 9933 | 998 |
| 9934 | 1072 |
| 9935 | 1086 |
| 9936 | 1047 |
| 9937 | 980 |
| 9938 | 918 |
| 9939 | 891 |
| 9940 | 878 |
| 9941 | 883 |
| 9942 | 877 |
| 9943 | 860 |
| 9944 | 837 |
| 9945 | 893 |
| 9946 | 886 |
| 9947 | 895 |
| 9948 | 884 |
| 9949 | 918 |
| 9950 | 919 |
| 9951 | 951 |
| 9952 | 1032 |
| 9953 | 1053 |
| 9954 | 1097 |
| 9955 | 1134 |
| 9956 | 1184 |
| 9957 | 1239 |
| 9958 | 1311 |
| 9959 | 1348 |
| 9960 | 1405 |
| 9961 | 1475 |
| 9962 | 1516 |
| 9963 | 1561 |
| 9964 | 1600 |
| 9965 | 1612 |
| 9966 | 1628 |
| 9967 | 1645 |
| 9968 | 1662 |
| 9969 | 1691 |
| 9970 | 1712 |
| 9971 | 1730 |
| 9972 | 1714 |
| 9973 | 1674 |
| 9974 | 1656 |
| 9975 | 1615 |
| 9976 | 1522 |
| 9977 | 1441 |
| 9978 | 1366 |
| 9979 | 1292 |
| 9980 | 1198 |
| 9981 | 1119 |
| 9982 | 1051 |
| 9983 | 993 |
| 9984 | 956 |
| 9985 | 940 |
| 9986 | 913 |
| 9987 | 882 |
| 9988 | 856 |
| 9989 | 840 |
| 9990 | 821 |
| 9991 | 803 |
| 9992 | 796 |
| 9993 | 791 |
| 9994 | 787 |
| 9995 | 779 |
| 9996 | 782 |
| 9997 | 781 |
| 9998 | 782 |
| 9999 | 785 |
| 10000 | 813 |
| 10001 | 821 |
| 10002 | 844 |
| 10003 | 866 |
| 10004 | 920 |
| 10005 | 936 |
| 10006 | 977 |
| 10007 | 1028 |
| 10008 | 1114 |
| 10009 | 1186 |
| 10010 | 1204 |
| 10011 | 1247 |
| 10012 | 1308 |
| 10013 | 1318 |
| 10014 | 1340 |
| 10015 | 1333 |
| 10016 | 1366 |
| 10017 | 1371 |
| 10018 | 1365 |
| 10019 | 1352 |
| 10020 | 1310 |
| 10021 | 1292 |
| 10022 | 1280 |
| 10023 | 1256 |
| 10024 | 1236 |
| 10025 | 1215 |
| 10026 | 1183 |
| 10027 | 1166 |
| 10028 | 1176 |
| 10029 | 1170 |
| 10030 | 1116 |
| 10031 | 1125 |
| 10032 | 1154 |
| 10033 | 1088 |
| 10034 | 1014 |
| 10035 | 957 |
| 10036 | 1028 |
| 10037 | 994 |
| 10038 | 994 |
| 10039 | 1080 |
| 10040 | 1119 |
| 10041 | 1100 |
| 10042 | 1111 |
| 10043 | 1096 |
| 10044 | 1130 |
| 10045 | 1142 |
| 10046 | 1154 |
| 10047 | 1167 |
| 10048 | 1182 |
| 10049 | 1185 |
| 10050 | 1186 |
| 10051 | 1191 |
| 10052 | 1253 |
| 10053 | 1339 |
| 10054 | 1383 |
| 10055 | 1440 |
| 10056 | 1456 |
| 10057 | 1449 |
| 10058 | 1492 |
| 10059 | 1540 |
| 10060 | 1551 |
| 10061 | 1559 |
| 10062 | 1586 |
| 10063 | 1626 |
| 10064 | 1649 |
| 10065 | 1668 |
| 10066 | 1664 |
| 10067 | 1671 |
| 10068 | 1677 |
| 10069 | 1632 |
| 10070 | 1612 |
| 10071 | 1588 |
| 10072 | 1496 |
| 10073 | 1415 |
| 10074 | 1334 |
| 10075 | 1255 |
| 10076 | 1173 |
| 10077 | 1102 |
| 10078 | 1038 |
| 10079 | 981 |
| 10080 | 971 |
| 10081 | 955 |
| 10082 | 920 |
| 10083 | 896 |
| 10084 | 871 |
| 10085 | 849 |
| 10086 | 833 |
| 10087 | 812 |
| 10088 | 803 |
| 10089 | 801 |
| 10090 | 789 |
| 10091 | 784 |
| 10092 | 791 |
| 10093 | 792 |
| 10094 | 796 |
| 10095 | 797 |
| 10096 | 815 |
| 10097 | 823 |
| 10098 | 840 |
| 10099 | 862 |
| 10100 | 903 |
| 10101 | 919 |
| 10102 | 972 |
| 10103 | 1016 |
| 10104 | 1100 |
| 10105 | 1156 |
| 10106 | 1184 |
| 10107 | 1226 |
| 10108 | 1288 |
| 10109 | 1308 |
| 10110 | 1315 |
| 10111 | 1330 |
| 10112 | 1369 |
| 10113 | 1375 |
| 10114 | 1364 |
| 10115 | 1346 |
| 10116 | 1316 |
| 10117 | 1285 |
| 10118 | 1270 |
| 10119 | 1228 |
| 10120 | 1154 |
| 10121 | 1114 |
| 10122 | 1088 |
| 10123 | 1064 |
| 10124 | 1022 |
| 10125 | 948 |
| 10126 | 915 |
| 10127 | 906 |
| 10128 | 842 |
| 10129 | 787 |
| 10130 | 738 |
| 10131 | 713 |
| 10132 | 688 |
| 10133 | 666 |
| 10134 | 666 |
| 10135 | 646 |
| 10136 | 683 |
| 10137 | 785 |
| 10138 | 774 |
| 10139 | 800 |
| 10140 | 816 |
| 10141 | 859 |
| 10142 | 949 |
| 10143 | 973 |
| 10144 | 951 |
| 10145 | 924 |
| 10146 | 1004 |
| 10147 | 1058 |
| 10148 | 1147 |
| 10149 | 1178 |
| 10150 | 1234 |
| 10151 | 1256 |
| 10152 | 1324 |
| 10153 | 1389 |
| 10154 | 1455 |
| 10155 | 1516 |
| 10156 | 1528 |
| 10157 | 1526 |
| 10158 | 1536 |
| 10159 | 1577 |
| 10160 | 1613 |
| 10161 | 1644 |
| 10162 | 1638 |
| 10163 | 1633 |
| 10164 | 1634 |
| 10165 | 1602 |
| 10166 | 1578 |
| 10167 | 1558 |
| 10168 | 1485 |
| 10169 | 1419 |
| 10170 | 1358 |
| 10171 | 1288 |
| 10172 | 1217 |
| 10173 | 1158 |
| 10174 | 1096 |
| 10175 | 1036 |
| 10176 | 1018 |
| 10177 | 994 |
| 10178 | 960 |
| 10179 | 927 |
| 10180 | 902 |
| 10181 | 881 |
| 10182 | 854 |
| 10183 | 834 |
| 10184 | 814 |
| 10185 | 799 |
| 10186 | 793 |
| 10187 | 790 |
| 10188 | 794 |
| 10189 | 791 |
| 10190 | 788 |
| 10191 | 788 |
| 10192 | 796 |
| 10193 | 803 |
| 10194 | 808 |
| 10195 | 814 |
| 10196 | 830 |
| 10197 | 835 |
| 10198 | 862 |
| 10199 | 862 |
| 10200 | 903 |
| 10201 | 923 |
| 10202 | 933 |
| 10203 | 963 |
| 10204 | 994 |
| 10205 | 1011 |
| 10206 | 1038 |
| 10207 | 1074 |
| 10208 | 1104 |
| 10209 | 1119 |
| 10210 | 1142 |
| 10211 | 1174 |
| 10212 | 1162 |
| 10213 | 1150 |
| 10214 | 1164 |
| 10215 | 1137 |
| 10216 | 1096 |
| 10217 | 1076 |
| 10218 | 1066 |
| 10219 | 1007 |
| 10220 | 954 |
| 10221 | 985 |
| 10222 | 1026 |
| 10223 | 1048 |
| 10224 | 1029 |
| 10225 | 988 |
| 10226 | 991 |
| 10227 | 943 |
| 10228 | 855 |
| 10229 | 761 |
| 10230 | 819 |
| 10231 | 857 |
| 10232 | 829 |
| 10233 | 836 |
| 10234 | 857 |
| 10235 | 916 |
| 10236 | 854 |
| 10237 | 717 |
| 10238 | 724 |
| 10239 | 768 |
| 10240 | 830 |
| 10241 | 879 |
| 10242 | 936 |
| 10243 | 978 |
| 10244 | 1046 |
| 10245 | 1086 |
| 10246 | 1178 |
| 10247 | 1286 |
| 10248 | 1342 |
| 10249 | 1409 |
| 10250 | 1508 |
| 10251 | 1552 |
| 10252 | 1582 |
| 10253 | 1610 |
| 10254 | 1611 |
| 10255 | 1614 |
| 10256 | 1616 |
| 10257 | 1601 |
| 10258 | 1600 |
| 10259 | 1588 |
| 10260 | 1578 |
| 10261 | 1538 |
| 10262 | 1511 |
| 10263 | 1492 |
| 10264 | 1428 |
| 10265 | 1367 |
| 10266 | 1320 |
| 10267 | 1264 |
| 10268 | 1195 |
| 10269 | 1146 |
| 10270 | 1086 |
| 10271 | 1033 |
| 10272 | 1010 |
| 10273 | 990 |
| 10274 | 943 |
| 10275 | 907 |
| 10276 | 878 |
| 10277 | 849 |
| 10278 | 828 |
| 10279 | 804 |
| 10280 | 793 |
| 10281 | 776 |
| 10282 | 764 |
| 10283 | 752 |
| 10284 | 748 |
| 10285 | 746 |
| 10286 | 745 |
| 10287 | 750 |
| 10288 | 756 |
| 10289 | 755 |
| 10290 | 759 |
| 10291 | 764 |
| 10292 | 778 |
| 10293 | 764 |
| 10294 | 773 |
| 10295 | 775 |
| 10296 | 806 |
| 10297 | 767 |
| 10298 | 768 |
| 10299 | 784 |
| 10300 | 811 |
| 10301 | 844 |
| 10302 | 878 |
| 10303 | 901 |
| 10304 | 934 |
| 10305 | 956 |
| 10306 | 988 |
| 10307 | 1040 |
| 10308 | 1085 |
| 10309 | 1088 |
| 10310 | 1143 |
| 10311 | 1129 |
| 10312 | 1094 |
| 10313 | 1072 |
| 10314 | 1062 |
| 10315 | 1072 |
| 10316 | 1065 |
| 10317 | 1121 |
| 10318 | 1130 |
| 10319 | 1081 |
| 10320 | 1041 |
| 10321 | 1031 |
| 10322 | 1027 |
| 10323 | 1017 |
| 10324 | 995 |
| 10325 | 992 |
| 10326 | 971 |
| 10327 | 951 |
| 10328 | 946 |
| 10329 | 958 |
| 10330 | 929 |
| 10331 | 923 |
| 10332 | 922 |
| 10333 | 932 |
| 10334 | 968 |
| 10335 | 987 |
| 10336 | 1026 |
| 10337 | 1051 |
| 10338 | 1042 |
| 10339 | 1036 |
| 10340 | 1088 |
| 10341 | 1150 |
| 10342 | 1211 |
| 10343 | 1263 |
| 10344 | 1312 |
| 10345 | 1361 |
| 10346 | 1392 |
| 10347 | 1418 |
| 10348 | 1430 |
| 10349 | 1449 |
| 10350 | 1466 |
| 10351 | 1480 |
| 10352 | 1500 |
| 10353 | 1505 |
| 10354 | 1523 |
| 10355 | 1526 |
| 10356 | 1530 |
| 10357 | 1505 |
| 10358 | 1486 |
| 10359 | 1479 |
| 10360 | 1408 |
| 10361 | 1332 |
| 10362 | 1257 |
| 10363 | 1183 |
| 10364 | 1102 |
| 10365 | 1032 |
| 10366 | 974 |
| 10367 | 924 |
| 10368 | 920 |
| 10369 | 902 |
| 10370 | 872 |
| 10371 | 841 |
| 10372 | 821 |
| 10373 | 801 |
| 10374 | 782 |
| 10375 | 768 |
| 10376 | 752 |
| 10377 | 744 |
| 10378 | 731 |
| 10379 | 724 |
| 10380 | 729 |
| 10381 | 725 |
| 10382 | 728 |
| 10383 | 737 |
| 10384 | 769 |
| 10385 | 788 |
| 10386 | 812 |
| 10387 | 838 |
| 10388 | 885 |
| 10389 | 902 |
| 10390 | 949 |
| 10391 | 1007 |
| 10392 | 1090 |
| 10393 | 1149 |
| 10394 | 1184 |
| 10395 | 1242 |
| 10396 | 1336 |
| 10397 | 1384 |
| 10398 | 1414 |
| 10399 | 1438 |
| 10400 | 1494 |
| 10401 | 1523 |
| 10402 | 1552 |
| 10403 | 1562 |
| 10404 | 1569 |
| 10405 | 1556 |
| 10406 | 1519 |
| 10407 | 1463 |
| 10408 | 1312 |
| 10409 | 1317 |
| 10410 | 1473 |
| 10411 | 1521 |
| 10412 | 1478 |
| 10413 | 1425 |
| 10414 | 1350 |
| 10415 | 1287 |
| 10416 | 1354 |
| 10417 | 1342 |
| 10418 | 1318 |
| 10419 | 1354 |
| 10420 | 1261 |
| 10421 | 1248 |
| 10422 | 1284 |
| 10423 | 1364 |
| 10424 | 1388 |
| 10425 | 1364 |
| 10426 | 1352 |
| 10427 | 1371 |
| 10428 | 1326 |
| 10429 | 1227 |
| 10430 | 1379 |
| 10431 | 1301 |
| 10432 | 1261 |
| 10433 | 1196 |
| 10434 | 1332 |
| 10435 | 1366 |
| 10436 | 1369 |
| 10437 | 1432 |
| 10438 | 1557 |
| 10439 | 1543 |
| 10440 | 1545 |
| 10441 | 1622 |
| 10442 | 1686 |
| 10443 | 1729 |
| 10444 | 1733 |
| 10445 | 1727 |
| 10446 | 1705 |
| 10447 | 1730 |
| 10448 | 1726 |
| 10449 | 1711 |
| 10450 | 1734 |
| 10451 | 1731 |
| 10452 | 1702 |
| 10453 | 1656 |
| 10454 | 1627 |
| 10455 | 1586 |
| 10456 | 1503 |
| 10457 | 1433 |
| 10458 | 1352 |
| 10459 | 1276 |
| 10460 | 1186 |
| 10461 | 1111 |
| 10462 | 1045 |
| 10463 | 1004 |
| 10464 | 1002 |
| 10465 | 988 |
| 10466 | 962 |
| 10467 | 932 |
| 10468 | 912 |
| 10469 | 890 |
| 10470 | 877 |
| 10471 | 860 |
| 10472 | 852 |
| 10473 | 843 |
| 10474 | 830 |
| 10475 | 822 |
| 10476 | 828 |
| 10477 | 826 |
| 10478 | 824 |
| 10479 | 823 |
| 10480 | 844 |
| 10481 | 851 |
| 10482 | 876 |
| 10483 | 902 |
| 10484 | 950 |
| 10485 | 969 |
| 10486 | 1007 |
| 10487 | 1058 |
| 10488 | 1171 |
| 10489 | 1198 |
| 10490 | 1237 |
| 10491 | 1302 |
| 10492 | 1390 |
| 10493 | 1432 |
| 10494 | 1465 |
| 10495 | 1482 |
| 10496 | 1516 |
| 10497 | 1551 |
| 10498 | 1588 |
| 10499 | 1610 |
| 10500 | 1602 |
| 10501 | 1606 |
| 10502 | 1594 |
| 10503 | 1590 |
| 10504 | 1590 |
| 10505 | 1574 |
| 10506 | 1583 |
| 10507 | 1568 |
| 10508 | 1530 |
| 10509 | 1577 |
| 10510 | 1586 |
| 10511 | 1500 |
| 10512 | 1506 |
| 10513 | 1424 |
| 10514 | 1317 |
| 10515 | 1289 |
| 10516 | 1324 |
| 10517 | 1334 |
| 10518 | 1318 |
| 10519 | 1256 |
| 10520 | 1310 |
| 10521 | 1338 |
| 10522 | 1286 |
| 10523 | 1275 |
| 10524 | 1245 |
| 10525 | 1234 |
| 10526 | 1292 |
| 10527 | 1324 |
| 10528 | 1327 |
| 10529 | 1358 |
| 10530 | 1381 |
| 10531 | 1386 |
| 10532 | 1408 |
| 10533 | 1408 |
| 10534 | 1452 |
| 10535 | 1489 |
| 10536 | 1557 |
| 10537 | 1606 |
| 10538 | 1644 |
| 10539 | 1677 |
| 10540 | 1712 |
| 10541 | 1727 |
| 10542 | 1735 |
| 10543 | 1734 |
| 10544 | 1727 |
| 10545 | 1717 |
| 10546 | 1717 |
| 10547 | 1715 |
| 10548 | 1731 |
| 10549 | 1704 |
| 10550 | 1684 |
| 10551 | 1649 |
| 10552 | 1558 |
| 10553 | 1485 |
| 10554 | 1417 |
| 10555 | 1332 |
| 10556 | 1242 |
| 10557 | 1164 |
| 10558 | 1098 |
| 10559 | 1046 |
| 10560 | 1012 |
| 10561 | 992 |
| 10562 | 958 |
| 10563 | 928 |
| 10564 | 906 |
| 10565 | 886 |
| 10566 | 866 |
| 10567 | 851 |
| 10568 | 836 |
| 10569 | 825 |
| 10570 | 820 |
| 10571 | 818 |
| 10572 | 823 |
| 10573 | 823 |
| 10574 | 823 |
| 10575 | 829 |
| 10576 | 863 |
| 10577 | 870 |
| 10578 | 890 |
| 10579 | 918 |
| 10580 | 962 |
| 10581 | 976 |
| 10582 | 1022 |
| 10583 | 1056 |
| 10584 | 1120 |
| 10585 | 1158 |
| 10586 | 1188 |
| 10587 | 1217 |
| 10588 | 1269 |
| 10589 | 1312 |
| 10590 | 1345 |
| 10591 | 1346 |
| 10592 | 1332 |
| 10593 | 1303 |
| 10594 | 1264 |
| 10595 | 1222 |
| 10596 | 1172 |
| 10597 | 1133 |
| 10598 | 1102 |
| 10599 | 1049 |
| 10600 | 1008 |
| 10601 | 978 |
| 10602 | 946 |
| 10603 | 934 |
| 10604 | 939 |
| 10605 | 974 |
| 10606 | 984 |
| 10607 | 1017 |
| 10608 | 1008 |
| 10609 | 950 |
| 10610 | 891 |
| 10611 | 854 |
| 10612 | 778 |
| 10613 | 724 |
| 10614 | 738 |
| 10615 | 744 |
| 10616 | 728 |
| 10617 | 744 |
| 10618 | 753 |
| 10619 | 780 |
| 10620 | 746 |
| 10621 | 740 |
| 10622 | 706 |
| 10623 | 777 |
| 10624 | 861 |
| 10625 | 920 |
| 10626 | 959 |
| 10627 | 1000 |
| 10628 | 1047 |
| 10629 | 1099 |
| 10630 | 1173 |
| 10631 | 1207 |
| 10632 | 1277 |
| 10633 | 1356 |
| 10634 | 1418 |
| 10635 | 1495 |
| 10636 | 1546 |
| 10637 | 1562 |
| 10638 | 1580 |
| 10639 | 1593 |
| 10640 | 1603 |
| 10641 | 1612 |
| 10642 | 1629 |
| 10643 | 1662 |
| 10644 | 1665 |
| 10645 | 1640 |
| 10646 | 1628 |
| 10647 | 1590 |
| 10648 | 1503 |
| 10649 | 1423 |
| 10650 | 1347 |
| 10651 | 1274 |
| 10652 | 1183 |
| 10653 | 1111 |
| 10654 | 1043 |
| 10655 | 989 |
| 10656 | 951 |
| 10657 | 929 |
| 10658 | 902 |
| 10659 | 873 |
| 10660 | 850 |
| 10661 | 834 |
| 10662 | 816 |
| 10663 | 800 |
| 10664 | 793 |
| 10665 | 783 |
| 10666 | 778 |
| 10667 | 774 |
| 10668 | 777 |
| 10669 | 780 |
| 10670 | 778 |
| 10671 | 783 |
| 10672 | 810 |
| 10673 | 815 |
| 10674 | 835 |
| 10675 | 858 |
| 10676 | 910 |
| 10677 | 926 |
| 10678 | 959 |
| 10679 | 998 |
| 10680 | 1065 |
| 10681 | 1129 |
| 10682 | 1152 |
| 10683 | 1191 |
| 10684 | 1237 |
| 10685 | 1237 |
| 10686 | 1253 |
| 10687 | 1263 |
| 10688 | 1274 |
| 10689 | 1267 |
| 10690 | 1250 |
| 10691 | 1220 |
| 10692 | 1164 |
| 10693 | 1142 |
| 10694 | 1121 |
| 10695 | 1102 |
| 10696 | 1093 |
| 10697 | 1051 |
| 10698 | 1016 |
| 10699 | 1019 |
| 10700 | 1038 |
| 10701 | 1041 |
| 10702 | 1043 |
| 10703 | 1074 |
| 10704 | 1067 |
| 10705 | 1012 |
| 10706 | 925 |
| 10707 | 895 |
| 10708 | 982 |
| 10709 | 947 |
| 10710 | 957 |
| 10711 | 1000 |
| 10712 | 1017 |
| 10713 | 923 |
| 10714 | 941 |
| 10715 | 932 |
| 10716 | 939 |
| 10717 | 930 |
| 10718 | 954 |
| 10719 | 981 |
| 10720 | 1015 |
| 10721 | 1031 |
| 10722 | 1043 |
| 10723 | 1042 |
| 10724 | 1103 |
| 10725 | 1213 |
| 10726 | 1270 |
| 10727 | 1349 |
| 10728 | 1378 |
| 10729 | 1372 |
| 10730 | 1404 |
| 10731 | 1450 |
| 10732 | 1465 |
| 10733 | 1484 |
| 10734 | 1516 |
| 10735 | 1561 |
| 10736 | 1579 |
| 10737 | 1586 |
| 10738 | 1579 |
| 10739 | 1608 |
| 10740 | 1634 |
| 10741 | 1593 |
| 10742 | 1574 |
| 10743 | 1543 |
| 10744 | 1455 |
| 10745 | 1382 |
| 10746 | 1306 |
| 10747 | 1229 |
| 10748 | 1146 |
| 10749 | 1075 |
| 10750 | 1017 |
| 10751 | 959 |
| 10752 | 943 |
| 10753 | 920 |
| 10754 | 883 |
| 10755 | 861 |
| 10756 | 834 |
| 10757 | 811 |
| 10758 | 798 |
| 10759 | 778 |
| 10760 | 770 |
| 10761 | 765 |
| 10762 | 751 |
| 10763 | 747 |
| 10764 | 754 |
| 10765 | 754 |
| 10766 | 757 |
| 10767 | 759 |
| 10768 | 780 |
| 10769 | 786 |
| 10770 | 806 |
| 10771 | 829 |
| 10772 | 871 |
| 10773 | 888 |
| 10774 | 937 |
| 10775 | 967 |
| 10776 | 1035 |
| 10777 | 1084 |
| 10778 | 1115 |
| 10779 | 1144 |
| 10780 | 1201 |
| 10781 | 1221 |
| 10782 | 1221 |
| 10783 | 1233 |
| 10784 | 1274 |
| 10785 | 1267 |
| 10786 | 1234 |
| 10787 | 1213 |
| 10788 | 1192 |
| 10789 | 1141 |
| 10790 | 1113 |
| 10791 | 1089 |
| 10792 | 1065 |
| 10793 | 1042 |
| 10794 | 1032 |
| 10795 | 1013 |
| 10796 | 994 |
| 10797 | 975 |
| 10798 | 942 |
| 10799 | 893 |
| 10800 | 830 |
| 10801 | 775 |
| 10802 | 724 |
| 10803 | 726 |
| 10804 | 701 |
| 10805 | 691 |
| 10806 | 709 |
| 10807 | 684 |
| 10808 | 699 |
| 10809 | 755 |
| 10810 | 687 |
| 10811 | 704 |
| 10812 | 750 |
| 10813 | 767 |
| 10814 | 808 |
| 10815 | 839 |
| 10816 | 848 |
| 10817 | 880 |
| 10818 | 974 |
| 10819 | 994 |
| 10820 | 1046 |
| 10821 | 1061 |
| 10822 | 1110 |
| 10823 | 1159 |
| 10824 | 1214 |
| 10825 | 1278 |
| 10826 | 1340 |
| 10827 | 1406 |
| 10828 | 1448 |
| 10829 | 1456 |
| 10830 | 1468 |
| 10831 | 1490 |
| 10832 | 1512 |
| 10833 | 1535 |
| 10834 | 1539 |
| 10835 | 1558 |
| 10836 | 1579 |
| 10837 | 1574 |
| 10838 | 1549 |
| 10839 | 1522 |
| 10840 | 1450 |
| 10841 | 1385 |
| 10842 | 1328 |
| 10843 | 1264 |
| 10844 | 1195 |
| 10845 | 1135 |
| 10846 | 1074 |
| 10847 | 1014 |
| 10848 | 1004 |
| 10849 | 982 |
| 10850 | 943 |
| 10851 | 912 |
| 10852 | 886 |
| 10853 | 871 |
| 10854 | 847 |
| 10855 | 825 |
| 10856 | 808 |
| 10857 | 792 |
| 10858 | 783 |
| 10859 | 780 |
| 10860 | 785 |
| 10861 | 777 |
| 10862 | 775 |
| 10863 | 774 |
| 10864 | 780 |
| 10865 | 785 |
| 10866 | 786 |
| 10867 | 795 |
| 10868 | 815 |
| 10869 | 815 |
| 10870 | 841 |
| 10871 | 831 |
| 10872 | 870 |
| 10873 | 892 |
| 10874 | 902 |
| 10875 | 921 |
| 10876 | 952 |
| 10877 | 971 |
| 10878 | 993 |
| 10879 | 1010 |
| 10880 | 1034 |
| 10881 | 1055 |
| 10882 | 1072 |
| 10883 | 1093 |
| 10884 | 1088 |
| 10885 | 1099 |
| 10886 | 1126 |
| 10887 | 1095 |
| 10888 | 1056 |
| 10889 | 1053 |
| 10890 | 1048 |
| 10891 | 1045 |
| 10892 | 1066 |
| 10893 | 1123 |
| 10894 | 1170 |
| 10895 | 1197 |
| 10896 | 1180 |
| 10897 | 1162 |
| 10898 | 1128 |
| 10899 | 1066 |
| 10900 | 1002 |
| 10901 | 922 |
| 10902 | 1012 |
| 10903 | 1029 |
| 10904 | 1004 |
| 10905 | 982 |
| 10906 | 998 |
| 10907 | 1030 |
| 10908 | 973 |
| 10909 | 806 |
| 10910 | 810 |
| 10911 | 864 |
| 10912 | 930 |
| 10913 | 1021 |
| 10914 | 1080 |
| 10915 | 1115 |
| 10916 | 1170 |
| 10917 | 1192 |
| 10918 | 1259 |
| 10919 | 1352 |
| 10920 | 1408 |
| 10921 | 1462 |
| 10922 | 1540 |
| 10923 | 1567 |
| 10924 | 1571 |
| 10925 | 1586 |
| 10926 | 1583 |
| 10927 | 1589 |
| 10928 | 1586 |
| 10929 | 1569 |
| 10930 | 1551 |
| 10931 | 1552 |
| 10932 | 1570 |
| 10933 | 1548 |
| 10934 | 1531 |
| 10935 | 1511 |
| 10936 | 1451 |
| 10937 | 1394 |
| 10938 | 1343 |
| 10939 | 1284 |
| 10940 | 1215 |
| 10941 | 1163 |
| 10942 | 1109 |
| 10943 | 1059 |
| 10944 | 1043 |
| 10945 | 1024 |
| 10946 | 978 |
| 10947 | 939 |
| 10948 | 906 |
| 10949 | 879 |
| 10950 | 859 |
| 10951 | 835 |
| 10952 | 823 |
| 10953 | 805 |
| 10954 | 794 |
| 10955 | 783 |
| 10956 | 775 |
| 10957 | 769 |
| 10958 | 768 |
| 10959 | 769 |
| 10960 | 774 |
| 10961 | 770 |
| 10962 | 773 |
| 10963 | 780 |
| 10964 | 791 |
| 10965 | 775 |
| 10966 | 777 |
| 10967 | 767 |
| 10968 | 789 |
| 10969 | 755 |
| 10970 | 759 |
| 10971 | 769 |
| 10972 | 790 |
| 10973 | 817 |
| 10974 | 847 |
| 10975 | 862 |
| 10976 | 878 |
| 10977 | 895 |
| 10978 | 932 |
| 10979 | 968 |
| 10980 | 994 |
| 10981 | 1002 |
| 10982 | 1035 |
| 10983 | 1037 |
| 10984 | 1032 |
| 10985 | 1037 |
| 10986 | 1047 |
| 10987 | 1090 |
| 10988 | 1136 |
| 10989 | 1180 |
| 10990 | 1196 |
| 10991 | 1183 |
| 10992 | 1138 |
| 10993 | 1098 |
| 10994 | 1064 |
| 10995 | 1038 |
| 10996 | 989 |
| 10997 | 976 |
| 10998 | 951 |
| 10999 | 934 |
| 11000 | 905 |
| 11001 | 886 |
| 11002 | 873 |
| 11003 | 850 |
| 11004 | 815 |
| 11005 | 810 |
| 11006 | 846 |
| 11007 | 846 |
| 11008 | 878 |
| 11009 | 894 |
| 11010 | 896 |
| 11011 | 915 |
| 11012 | 961 |
| 11013 | 1014 |
| 11014 | 1081 |
| 11015 | 1139 |
| 11016 | 1193 |
| 11017 | 1252 |
| 11018 | 1296 |
| 11019 | 1334 |
| 11020 | 1362 |
| 11021 | 1394 |
| 11022 | 1413 |
| 11023 | 1428 |
| 11024 | 1466 |
| 11025 | 1477 |
| 11026 | 1479 |
| 11027 | 1484 |
| 11028 | 1515 |
| 11029 | 1511 |
| 11030 | 1497 |
| 11031 | 1488 |
| 11032 | 1413 |
| 11033 | 1338 |
| 11034 | 1259 |
| 11035 | 1189 |
| 11036 | 1105 |
| 11037 | 1038 |
| 11038 | 977 |
| 11039 | 926 |
| 11040 | 916 |
| 11041 | 902 |
| 11042 | 870 |
| 11043 | 840 |
| 11044 | 821 |
| 11045 | 802 |
| 11046 | 783 |
| 11047 | 771 |
| 11048 | 759 |
| 11049 | 751 |
| 11050 | 740 |
| 11051 | 734 |
| 11052 | 740 |
| 11053 | 740 |
| 11054 | 743 |
| 11055 | 751 |
| 11056 | 783 |
| 11057 | 801 |
| 11058 | 826 |
| 11059 | 848 |
| 11060 | 902 |
| 11061 | 923 |
| 11062 | 965 |
| 11063 | 1018 |
| 11064 | 1098 |
| 11065 | 1159 |
| 11066 | 1202 |
| 11067 | 1255 |
| 11068 | 1324 |
| 11069 | 1347 |
| 11070 | 1364 |
| 11071 | 1376 |
| 11072 | 1405 |
| 11073 | 1413 |
| 11074 | 1415 |
| 11075 | 1406 |
| 11076 | 1384 |
| 11077 | 1355 |
| 11078 | 1340 |
| 11079 | 1344 |
| 11080 | 1289 |
| 11081 | 1265 |
| 11082 | 1287 |
| 11083 | 1284 |
| 11084 | 1267 |
| 11085 | 1274 |
| 11086 | 1276 |
| 11087 | 1263 |
| 11088 | 1303 |
| 11089 | 1320 |
| 11090 | 1293 |
| 11091 | 1289 |
| 11092 | 1237 |
| 11093 | 1220 |
| 11094 | 1240 |
| 11095 | 1286 |
| 11096 | 1290 |
| 11097 | 1242 |
| 11098 | 1193 |
| 11099 | 1186 |
| 11100 | 1180 |
| 11101 | 1157 |
| 11102 | 1207 |
| 11103 | 1184 |
| 11104 | 1161 |
| 11105 | 1162 |
| 11106 | 1215 |
| 11107 | 1226 |
| 11108 | 1250 |
| 11109 | 1317 |
| 11110 | 1400 |
| 11111 | 1429 |
| 11112 | 1462 |
| 11113 | 1513 |
| 11114 | 1567 |
| 11115 | 1609 |
| 11116 | 1628 |
| 11117 | 1635 |
| 11118 | 1649 |
| 11119 | 1670 |
| 11120 | 1678 |
| 11121 | 1663 |
| 11122 | 1668 |
| 11123 | 1671 |
| 11124 | 1664 |
| 11125 | 1646 |
| 11126 | 1622 |
| 11127 | 1578 |
| 11128 | 1494 |
| 11129 | 1420 |
| 11130 | 1336 |
| 11131 | 1258 |
| 11132 | 1167 |
| 11133 | 1095 |
| 11134 | 1031 |
| 11135 | 984 |
| 11136 | 973 |
| 11137 | 953 |
| 11138 | 923 |
| 11139 | 897 |
| 11140 | 876 |
| 11141 | 857 |
| 11142 | 842 |
| 11143 | 825 |
| 11144 | 818 |
| 11145 | 812 |
| 11146 | 800 |
| 11147 | 793 |
| 11148 | 801 |
| 11149 | 800 |
| 11150 | 803 |
| 11151 | 806 |
| 11152 | 832 |
| 11153 | 838 |
| 11154 | 864 |
| 11155 | 890 |
| 11156 | 938 |
| 11157 | 959 |
| 11158 | 993 |
| 11159 | 1038 |
| 11160 | 1148 |
| 11161 | 1178 |
| 11162 | 1215 |
| 11163 | 1265 |
| 11164 | 1337 |
| 11165 | 1369 |
| 11166 | 1390 |
| 11167 | 1420 |
| 11168 | 1470 |
| 11169 | 1483 |
| 11170 | 1479 |
| 11171 | 1458 |
| 11172 | 1452 |
| 11173 | 1450 |
| 11174 | 1432 |
| 11175 | 1421 |
| 11176 | 1431 |
| 11177 | 1410 |
| 11178 | 1359 |
| 11179 | 1357 |
| 11180 | 1336 |
| 11181 | 1367 |
| 11182 | 1384 |
| 11183 | 1305 |
| 11184 | 1248 |
| 11185 | 1199 |
| 11186 | 1148 |
| 11187 | 1113 |
| 11188 | 1136 |
| 11189 | 1186 |
| 11190 | 1210 |
| 11191 | 1172 |
| 11192 | 1176 |
| 11193 | 1203 |
| 11194 | 1215 |
| 11195 | 1232 |
| 11196 | 1220 |
| 11197 | 1213 |
| 11198 | 1229 |
| 11199 | 1253 |
| 11200 | 1285 |
| 11201 | 1336 |
| 11202 | 1338 |
| 11203 | 1255 |
| 11204 | 1251 |
| 11205 | 1306 |
| 11206 | 1370 |
| 11207 | 1448 |
| 11208 | 1526 |
| 11209 | 1568 |
| 11210 | 1599 |
| 11211 | 1615 |
| 11212 | 1645 |
| 11213 | 1647 |
| 11214 | 1658 |
| 11215 | 1655 |
| 11216 | 1634 |
| 11217 | 1615 |
| 11218 | 1611 |
| 11219 | 1617 |
| 11220 | 1652 |
| 11221 | 1647 |
| 11222 | 1637 |
| 11223 | 1603 |
| 11224 | 1515 |
| 11225 | 1434 |
| 11226 | 1363 |
| 11227 | 1279 |
| 11228 | 1185 |
| 11229 | 1109 |
| 11230 | 1041 |
| 11231 | 992 |
| 11232 | 952 |
| 11233 | 928 |
| 11234 | 892 |
| 11235 | 860 |
| 11236 | 837 |
| 11237 | 817 |
| 11238 | 799 |
| 11239 | 782 |
| 11240 | 766 |
| 11241 | 754 |
| 11242 | 746 |
| 11243 | 745 |
| 11244 | 752 |
| 11245 | 761 |
| 11246 | 761 |
| 11247 | 770 |
| 11248 | 810 |
| 11249 | 820 |
| 11250 | 844 |
| 11251 | 869 |
| 11252 | 916 |
| 11253 | 938 |
| 11254 | 996 |
| 11255 | 1029 |
| 11256 | 1104 |
| 11257 | 1162 |
| 11258 | 1191 |
| 11259 | 1200 |
| 11260 | 1242 |
| 11261 | 1306 |
| 11262 | 1356 |
| 11263 | 1364 |
| 11264 | 1369 |
| 11265 | 1350 |
| 11266 | 1309 |
| 11267 | 1280 |
| 11268 | 1250 |
| 11269 | 1216 |
| 11270 | 1191 |
| 11271 | 1130 |
| 11272 | 1112 |
| 11273 | 1104 |
| 11274 | 1084 |
| 11275 | 1058 |
| 11276 | 1070 |
| 11277 | 1090 |
| 11278 | 1040 |
| 11279 | 1092 |
| 11280 | 1138 |
| 11281 | 1060 |
| 11282 | 993 |
| 11283 | 994 |
| 11284 | 834 |
| 11285 | 640 |
| 11286 | 694 |
| 11287 | 726 |
| 11288 | 710 |
| 11289 | 680 |
| 11290 | 763 |
| 11291 | 919 |
| 11292 | 902 |
| 11293 | 772 |
| 11294 | 714 |
| 11295 | 777 |
| 11296 | 874 |
| 11297 | 1012 |
| 11298 | 988 |
| 11299 | 1028 |
| 11300 | 1054 |
| 11301 | 1093 |
| 11302 | 1152 |
| 11303 | 1195 |
| 11304 | 1259 |
| 11305 | 1319 |
| 11306 | 1394 |
| 11307 | 1494 |
| 11308 | 1545 |
| 11309 | 1569 |
| 11310 | 1581 |
| 11311 | 1596 |
| 11312 | 1598 |
| 11313 | 1580 |
| 11314 | 1575 |
| 11315 | 1594 |
| 11316 | 1615 |
| 11317 | 1607 |
| 11318 | 1599 |
| 11319 | 1560 |
| 11320 | 1473 |
| 11321 | 1388 |
| 11322 | 1309 |
| 11323 | 1238 |
| 11324 | 1146 |
| 11325 | 1072 |
| 11326 | 1011 |
| 11327 | 959 |
| 11328 | 946 |
| 11329 | 922 |
| 11330 | 894 |
| 11331 | 866 |
| 11332 | 845 |
| 11333 | 828 |
| 11334 | 810 |
| 11335 | 799 |
| 11336 | 791 |
| 11337 | 779 |
| 11338 | 772 |
| 11339 | 771 |
| 11340 | 775 |
| 11341 | 778 |
| 11342 | 776 |
| 11343 | 780 |
| 11344 | 808 |
| 11345 | 813 |
| 11346 | 832 |
| 11347 | 858 |
| 11348 | 908 |
| 11349 | 925 |
| 11350 | 952 |
| 11351 | 978 |
| 11352 | 1051 |
| 11353 | 1109 |
| 11354 | 1138 |
| 11355 | 1175 |
| 11356 | 1208 |
| 11357 | 1198 |
| 11358 | 1206 |
| 11359 | 1242 |
| 11360 | 1233 |
| 11361 | 1219 |
| 11362 | 1201 |
| 11363 | 1164 |
| 11364 | 1098 |
| 11365 | 1080 |
| 11366 | 1060 |
| 11367 | 1066 |
| 11368 | 1086 |
| 11369 | 1036 |
| 11370 | 1018 |
| 11371 | 1062 |
| 11372 | 1112 |
| 11373 | 1118 |
| 11374 | 1180 |
| 11375 | 1229 |
| 11376 | 1195 |
| 11377 | 1122 |
| 11378 | 1000 |
| 11379 | 970 |
| 11380 | 1086 |
| 11381 | 1043 |
| 11382 | 1050 |
| 11383 | 1046 |
| 11384 | 1028 |
| 11385 | 854 |
| 11386 | 864 |
| 11387 | 928 |
| 11388 | 915 |
| 11389 | 891 |
| 11390 | 921 |
| 11391 | 952 |
| 11392 | 1004 |
| 11393 | 1042 |
| 11394 | 1079 |
| 11395 | 1080 |
| 11396 | 1102 |
| 11397 | 1206 |
| 11398 | 1275 |
| 11399 | 1366 |
| 11400 | 1417 |
| 11401 | 1440 |
| 11402 | 1461 |
| 11403 | 1494 |
| 11404 | 1509 |
| 11405 | 1525 |
| 11406 | 1546 |
| 11407 | 1582 |
| 11408 | 1587 |
| 11409 | 1579 |
| 11410 | 1570 |
| 11411 | 1602 |
| 11412 | 1630 |
| 11413 | 1592 |
| 11414 | 1568 |
| 11415 | 1527 |
| 11416 | 1440 |
| 11417 | 1367 |
| 11418 | 1293 |
| 11419 | 1214 |
| 11420 | 1130 |
| 11421 | 1058 |
| 11422 | 1006 |
| 11423 | 945 |
| 11424 | 929 |
| 11425 | 901 |
| 11426 | 862 |
| 11427 | 842 |
| 11428 | 814 |
| 11429 | 792 |
| 11430 | 777 |
| 11431 | 757 |
| 11432 | 750 |
| 11433 | 738 |
| 11434 | 726 |
| 11435 | 722 |
| 11436 | 730 |
| 11437 | 728 |
| 11438 | 728 |
| 11439 | 730 |
| 11440 | 756 |
| 11441 | 763 |
| 11442 | 782 |
| 11443 | 806 |
| 11444 | 852 |
| 11445 | 868 |
| 11446 | 912 |
| 11447 | 934 |
| 11448 | 1013 |
| 11449 | 1064 |
| 11450 | 1100 |
| 11451 | 1118 |
| 11452 | 1177 |
| 11453 | 1208 |
| 11454 | 1202 |
| 11455 | 1234 |
| 11456 | 1292 |
| 11457 | 1269 |
| 11458 | 1206 |
| 11459 | 1187 |
| 11460 | 1191 |
| 11461 | 1108 |
| 11462 | 1058 |
| 11463 | 1082 |
| 11464 | 1126 |
| 11465 | 1143 |
| 11466 | 1177 |
| 11467 | 1160 |
| 11468 | 1162 |
| 11469 | 1202 |
| 11470 | 1155 |
| 11471 | 1014 |
| 11472 | 914 |
| 11473 | 852 |
| 11474 | 767 |
| 11475 | 786 |
| 11476 | 817 |
| 11477 | 801 |
| 11478 | 815 |
| 11479 | 815 |
| 11480 | 828 |
| 11481 | 784 |
| 11482 | 648 |
| 11483 | 650 |
| 11484 | 771 |
| 11485 | 758 |
| 11486 | 755 |
| 11487 | 841 |
| 11488 | 856 |
| 11489 | 922 |
| 11490 | 1028 |
| 11491 | 1022 |
| 11492 | 1019 |
| 11493 | 1018 |
| 11494 | 1040 |
| 11495 | 1114 |
| 11496 | 1164 |
| 11497 | 1236 |
| 11498 | 1302 |
| 11499 | 1364 |
| 11500 | 1428 |
| 11501 | 1438 |
| 11502 | 1449 |
| 11503 | 1456 |
| 11504 | 1460 |
| 11505 | 1476 |
| 11506 | 1489 |
| 11507 | 1512 |
| 11508 | 1532 |
| 11509 | 1569 |
| 11510 | 1544 |
| 11511 | 1516 |
| 11512 | 1443 |
| 11513 | 1372 |
| 11514 | 1317 |
| 11515 | 1256 |
| 11516 | 1186 |
| 11517 | 1126 |
| 11518 | 1066 |
| 11519 | 1006 |
| 11520 | 998 |
| 11521 | 975 |
| 11522 | 936 |
| 11523 | 911 |
| 11524 | 884 |
| 11525 | 869 |
| 11526 | 850 |
| 11527 | 830 |
| 11528 | 816 |
| 11529 | 799 |
| 11530 | 787 |
| 11531 | 782 |
| 11532 | 784 |
| 11533 | 774 |
| 11534 | 773 |
| 11535 | 770 |
| 11536 | 778 |
| 11537 | 782 |
| 11538 | 784 |
| 11539 | 795 |
| 11540 | 818 |
| 11541 | 811 |
| 11542 | 820 |
| 11543 | 807 |
| 11544 | 851 |
| 11545 | 875 |
| 11546 | 893 |
| 11547 | 916 |
| 11548 | 948 |
| 11549 | 976 |
| 11550 | 1003 |
| 11551 | 1015 |
| 11552 | 1042 |
| 11553 | 1069 |
| 11554 | 1085 |
| 11555 | 1094 |
| 11556 | 1055 |
| 11557 | 1052 |
| 11558 | 1079 |
| 11559 | 1074 |
| 11560 | 1104 |
| 11561 | 1105 |
| 11562 | 1103 |
| 11563 | 1123 |
| 11564 | 1171 |
| 11565 | 1258 |
| 11566 | 1287 |
| 11567 | 1259 |
| 11568 | 1248 |
| 11569 | 1232 |
| 11570 | 1204 |
| 11571 | 1136 |
| 11572 | 1042 |
| 11573 | 990 |
| 11574 | 1123 |
| 11575 | 1161 |
| 11576 | 1170 |
| 11577 | 1179 |
| 11578 | 1198 |
| 11579 | 1214 |
| 11580 | 1159 |
| 11581 | 1049 |
| 11582 | 1067 |
| 11583 | 1101 |
| 11584 | 1123 |
| 11585 | 1206 |
| 11586 | 1249 |
| 11587 | 1268 |
| 11588 | 1296 |
| 11589 | 1322 |
| 11590 | 1395 |
| 11591 | 1477 |
| 11592 | 1516 |
| 11593 | 1538 |
| 11594 | 1591 |
| 11595 | 1602 |
| 11596 | 1596 |
| 11597 | 1603 |
| 11598 | 1592 |
| 11599 | 1588 |
| 11600 | 1577 |
| 11601 | 1559 |
| 11602 | 1537 |
| 11603 | 1535 |
| 11604 | 1562 |
| 11605 | 1543 |
| 11606 | 1530 |
| 11607 | 1508 |
| 11608 | 1449 |
| 11609 | 1394 |
| 11610 | 1337 |
| 11611 | 1276 |
| 11612 | 1209 |
| 11613 | 1157 |
| 11614 | 1102 |
| 11615 | 1063 |
| 11616 | 1054 |
| 11617 | 1033 |
| 11618 | 988 |
| 11619 | 946 |
| 11620 | 912 |
| 11621 | 882 |
| 11622 | 862 |
| 11623 | 835 |
| 11624 | 820 |
| 11625 | 801 |
| 11626 | 790 |
| 11627 | 779 |
| 11628 | 768 |
| 11629 | 757 |
| 11630 | 757 |
| 11631 | 760 |
| 11632 | 769 |
| 11633 | 764 |
| 11634 | 768 |
| 11635 | 775 |
| 11636 | 779 |
| 11637 | 762 |
| 11638 | 756 |
| 11639 | 738 |
| 11640 | 758 |
| 11641 | 740 |
| 11642 | 747 |
| 11643 | 750 |
| 11644 | 761 |
| 11645 | 778 |
| 11646 | 810 |
| 11647 | 830 |
| 11648 | 842 |
| 11649 | 848 |
| 11650 | 854 |
| 11651 | 862 |
| 11652 | 890 |
| 11653 | 940 |
| 11654 | 957 |
| 11655 | 984 |
| 11656 | 955 |
| 11657 | 1032 |
| 11658 | 1127 |
| 11659 | 1193 |
| 11660 | 1201 |
| 11661 | 1098 |
| 11662 | 1142 |
| 11663 | 1203 |
| 11664 | 1159 |
| 11665 | 1023 |
| 11666 | 913 |
| 11667 | 953 |
| 11668 | 997 |
| 11669 | 884 |
| 11670 | 805 |
| 11671 | 777 |
| 11672 | 806 |
| 11673 | 817 |
| 11674 | 739 |
| 11675 | 761 |
| 11676 | 700 |
| 11677 | 699 |
| 11678 | 751 |
| 11679 | 776 |
| 11680 | 853 |
| 11681 | 916 |
| 11682 | 882 |
| 11683 | 828 |
| 11684 | 805 |
| 11685 | 830 |
| 11686 | 909 |
| 11687 | 990 |
| 11688 | 1076 |
| 11689 | 1151 |
| 11690 | 1204 |
| 11691 | 1269 |
| 11692 | 1315 |
| 11693 | 1378 |
| 11694 | 1371 |
| 11695 | 1391 |
| 11696 | 1429 |
| 11697 | 1445 |
| 11698 | 1438 |
| 11699 | 1439 |
| 11700 | 1471 |
| 11701 | 1487 |
| 11702 | 1493 |
| 11703 | 1483 |
| 11704 | 1409 |
| 11705 | 1338 |
| 11706 | 1254 |
| 11707 | 1182 |
| 11708 | 1103 |
| 11709 | 1032 |
| 11710 | 971 |
| 11711 | 919 |
| 11712 | 907 |
| 11713 | 889 |
| 11714 | 855 |
| 11715 | 825 |
| 11716 | 804 |
| 11717 | 788 |
| 11718 | 771 |
| 11719 | 757 |
| 11720 | 750 |
| 11721 | 744 |
| 11722 | 733 |
| 11723 | 727 |
| 11724 | 735 |
| 11725 | 735 |
| 11726 | 741 |
| 11727 | 750 |
| 11728 | 785 |
| 11729 | 800 |
| 11730 | 825 |
| 11731 | 849 |
| 11732 | 900 |
| 11733 | 924 |
| 11734 | 955 |
| 11735 | 1004 |
| 11736 | 1092 |
| 11737 | 1149 |
| 11738 | 1189 |
| 11739 | 1233 |
| 11740 | 1282 |
| 11741 | 1289 |
| 11742 | 1292 |
| 11743 | 1299 |
| 11744 | 1311 |
| 11745 | 1298 |
| 11746 | 1291 |
| 11747 | 1286 |
| 11748 | 1246 |
| 11749 | 1253 |
| 11750 | 1282 |
| 11751 | 1315 |
| 11752 | 1303 |
| 11753 | 1270 |
| 11754 | 1213 |
| 11755 | 1227 |
| 11756 | 1153 |
| 11757 | 1201 |
| 11758 | 1191 |
| 11759 | 1227 |
| 11760 | 1219 |
| 11761 | 1236 |
| 11762 | 1164 |
| 11763 | 1187 |
| 11764 | 1211 |
| 11765 | 1149 |
| 11766 | 1176 |
| 11767 | 1120 |
| 11768 | 1148 |
| 11769 | 1151 |
| 11770 | 1009 |
| 11771 | 1008 |
| 11772 | 991 |
| 11773 | 993 |
| 11774 | 970 |
| 11775 | 1037 |
| 11776 | 1082 |
| 11777 | 1124 |
| 11778 | 1117 |
| 11779 | 1084 |
| 11780 | 1099 |
| 11781 | 1182 |
| 11782 | 1243 |
| 11783 | 1315 |
| 11784 | 1367 |
| 11785 | 1401 |
| 11786 | 1446 |
| 11787 | 1504 |
| 11788 | 1564 |
| 11789 | 1581 |
| 11790 | 1600 |
| 11791 | 1612 |
| 11792 | 1627 |
| 11793 | 1613 |
| 11794 | 1611 |
| 11795 | 1614 |
| 11796 | 1614 |
| 11797 | 1627 |
| 11798 | 1620 |
| 11799 | 1579 |
| 11800 | 1496 |
| 11801 | 1417 |
| 11802 | 1330 |
| 11803 | 1250 |
| 11804 | 1158 |
| 11805 | 1085 |
| 11806 | 1026 |
| 11807 | 974 |
| 11808 | 962 |
| 11809 | 944 |
| 11810 | 914 |
| 11811 | 889 |
| 11812 | 867 |
| 11813 | 849 |
| 11814 | 833 |
| 11815 | 817 |
| 11816 | 807 |
| 11817 | 799 |
| 11818 | 789 |
| 11819 | 785 |
| 11820 | 789 |
| 11821 | 788 |
| 11822 | 794 |
| 11823 | 799 |
| 11824 | 824 |
| 11825 | 831 |
| 11826 | 857 |
| 11827 | 883 |
| 11828 | 932 |
| 11829 | 953 |
| 11830 | 970 |
| 11831 | 1016 |
| 11832 | 1123 |
| 11833 | 1166 |
| 11834 | 1209 |
| 11835 | 1262 |
| 11836 | 1322 |
| 11837 | 1348 |
| 11838 | 1358 |
| 11839 | 1393 |
| 11840 | 1454 |
| 11841 | 1450 |
| 11842 | 1433 |
| 11843 | 1416 |
| 11844 | 1407 |
| 11845 | 1377 |
| 11846 | 1349 |
| 11847 | 1343 |
| 11848 | 1347 |
| 11849 | 1316 |
| 11850 | 1264 |
| 11851 | 1255 |
| 11852 | 1236 |
| 11853 | 1246 |
| 11854 | 1254 |
| 11855 | 1226 |
| 11856 | 1177 |
| 11857 | 1083 |
| 11858 | 1015 |
| 11859 | 1017 |
| 11860 | 987 |
| 11861 | 1029 |
| 11862 | 1060 |
| 11863 | 1013 |
| 11864 | 1011 |
| 11865 | 1035 |
| 11866 | 1053 |
| 11867 | 1108 |
| 11868 | 1128 |
| 11869 | 1192 |
| 11870 | 1239 |
| 11871 | 1241 |
| 11872 | 1235 |
| 11873 | 1289 |
| 11874 | 1303 |
| 11875 | 1216 |
| 11876 | 1187 |
| 11877 | 1228 |
| 11878 | 1267 |
| 11879 | 1331 |
| 11880 | 1432 |
| 11881 | 1505 |
| 11882 | 1549 |
| 11883 | 1605 |
| 11884 | 1650 |
| 11885 | 1643 |
| 11886 | 1637 |
| 11887 | 1606 |
| 11888 | 1582 |
| 11889 | 1567 |
| 11890 | 1560 |
| 11891 | 1566 |
| 11892 | 1600 |
| 11893 | 1605 |
| 11894 | 1619 |
| 11895 | 1586 |
| 11896 | 1498 |
| 11897 | 1415 |
| 11898 | 1343 |
| 11899 | 1258 |
| 11900 | 1163 |
| 11901 | 1087 |
| 11902 | 1018 |
| 11903 | 969 |
| 11904 | 943 |
| 11905 | 918 |
| 11906 | 881 |
| 11907 | 855 |
| 11908 | 829 |
| 11909 | 809 |
| 11910 | 794 |
| 11911 | 774 |
| 11912 | 764 |
| 11913 | 750 |
| 11914 | 743 |
| 11915 | 741 |
| 11916 | 748 |
| 11917 | 751 |
| 11918 | 751 |
| 11919 | 758 |
| 11920 | 792 |
| 11921 | 801 |
| 11922 | 822 |
| 11923 | 846 |
| 11924 | 899 |
| 11925 | 913 |
| 11926 | 954 |
| 11927 | 985 |
| 11928 | 1080 |
| 11929 | 1136 |
| 11930 | 1172 |
| 11931 | 1186 |
| 11932 | 1235 |
| 11933 | 1278 |
| 11934 | 1294 |
| 11935 | 1316 |
| 11936 | 1342 |
| 11937 | 1310 |
| 11938 | 1260 |
| 11939 | 1228 |
| 11940 | 1207 |
| 11941 | 1156 |
| 11942 | 1132 |
| 11943 | 1131 |
| 11944 | 1145 |
| 11945 | 1155 |
| 11946 | 1172 |
| 11947 | 1142 |
| 11948 | 1162 |
| 11949 | 1164 |
| 11950 | 1136 |
| 11951 | 1096 |
| 11952 | 1043 |
| 11953 | 999 |
| 11954 | 920 |
| 11955 | 922 |
| 11956 | 851 |
| 11957 | 772 |
| 11958 | 792 |
| 11959 | 808 |
| 11960 | 819 |
| 11961 | 750 |
| 11962 | 749 |
| 11963 | 870 |
| 11964 | 925 |
| 11965 | 796 |
| 11966 | 761 |
| 11967 | 823 |
| 11968 | 864 |
| 11969 | 961 |
| 11970 | 1007 |
| 11971 | 1021 |
| 11972 | 1026 |
| 11973 | 1044 |
| 11974 | 1102 |
| 11975 | 1183 |
| 11976 | 1246 |
| 11977 | 1305 |
| 11978 | 1361 |
| 11979 | 1411 |
| 11980 | 1455 |
| 11981 | 1477 |
| 11982 | 1497 |
| 11983 | 1517 |
| 11984 | 1526 |
| 11985 | 1526 |
| 11986 | 1526 |
| 11987 | 1533 |
| 11988 | 1554 |
| 11989 | 1588 |
| 11990 | 1588 |
| 11991 | 1561 |
| 11992 | 1484 |
| 11993 | 1402 |
| 11994 | 1332 |
| 11995 | 1260 |
| 11996 | 1178 |
| 11997 | 1111 |
| 11998 | 1048 |
| 11999 | 992 |
| 12000 | 1048 |
| 12001 | 1026 |
| 12002 | 982 |
| 12003 | 941 |
| 12004 | 909 |
| 12005 | 879 |
| 12006 | 859 |
| 12007 | 834 |
| 12008 | 818 |
| 12009 | 800 |
| 12010 | 790 |
| 12011 | 778 |
| 12012 | 768 |
| 12013 | 757 |
| 12014 | 756 |
| 12015 | 759 |
| 12016 | 768 |
| 12017 | 765 |
| 12018 | 769 |
| 12019 | 776 |
| 12020 | 780 |
| 12021 | 758 |
| 12022 | 750 |
| 12023 | 730 |
| 12024 | 749 |
| 12025 | 740 |
| 12026 | 746 |
| 12027 | 746 |
| 12028 | 756 |
| 12029 | 764 |
| 12030 | 786 |
| 12031 | 800 |
| 12032 | 812 |
| 12033 | 819 |
| 12034 | 807 |
| 12035 | 804 |
| 12036 | 810 |
| 12037 | 852 |
| 12038 | 853 |
| 12039 | 870 |
| 12040 | 836 |
| 12041 | 919 |
| 12042 | 1022 |
| 12043 | 1090 |
| 12044 | 1103 |
| 12045 | 985 |
| 12046 | 1021 |
| 12047 | 1087 |
| 12048 | 1047 |
| 12049 | 906 |
| 12050 | 798 |
| 12051 | 857 |
| 12052 | 898 |
| 12053 | 810 |
| 12054 | 735 |
| 12055 | 692 |
| 12056 | 714 |
| 12057 | 719 |
| 12058 | 647 |
| 12059 | 671 |
| 12060 | 598 |
| 12061 | 588 |
| 12062 | 640 |
| 12063 | 648 |
| 12064 | 720 |
| 12065 | 792 |
| 12066 | 770 |
| 12067 | 722 |
| 12068 | 712 |
| 12069 | 744 |
| 12070 | 836 |
| 12071 | 924 |
| 12072 | 1014 |
| 12073 | 1090 |
| 12074 | 1150 |
| 12075 | 1219 |
| 12076 | 1273 |
| 12077 | 1340 |
| 12078 | 1335 |
| 12079 | 1355 |
| 12080 | 1392 |
| 12081 | 1412 |
| 12082 | 1409 |
| 12083 | 1405 |
| 12084 | 1435 |
| 12085 | 1454 |
| 12086 | 1475 |
| 12087 | 1469 |
| 12088 | 1394 |
| 12089 | 1326 |
| 12090 | 1246 |
| 12091 | 1174 |
| 12092 | 1094 |
| 12093 | 1025 |
| 12094 | 964 |
| 12095 | 911 |
| 12096 | 972 |
| 12097 | 948 |
| 12098 | 908 |
| 12099 | 883 |
| 12100 | 856 |
| 12101 | 837 |
| 12102 | 822 |
| 12103 | 800 |
| 12104 | 791 |
| 12105 | 777 |
| 12106 | 767 |
| 12107 | 761 |
| 12108 | 765 |
| 12109 | 757 |
| 12110 | 754 |
| 12111 | 755 |
| 12112 | 778 |
| 12113 | 783 |
| 12114 | 794 |
| 12115 | 811 |
| 12116 | 850 |
| 12117 | 845 |
| 12118 | 861 |
| 12119 | 872 |
| 12120 | 948 |
| 12121 | 986 |
| 12122 | 1019 |
| 12123 | 1043 |
| 12124 | 1091 |
| 12125 | 1122 |
| 12126 | 1132 |
| 12127 | 1157 |
| 12128 | 1190 |
| 12129 | 1178 |
| 12130 | 1156 |
| 12131 | 1138 |
| 12132 | 1116 |
| 12133 | 1059 |
| 12134 | 1046 |
| 12135 | 1072 |
| 12136 | 1114 |
| 12137 | 1117 |
| 12138 | 1138 |
| 12139 | 1159 |
| 12140 | 1175 |
| 12141 | 1211 |
| 12142 | 1171 |
| 12143 | 1065 |
| 12144 | 1014 |
| 12145 | 978 |
| 12146 | 902 |
| 12147 | 893 |
| 12148 | 881 |
| 12149 | 840 |
| 12150 | 899 |
| 12151 | 896 |
| 12152 | 933 |
| 12153 | 902 |
| 12154 | 833 |
| 12155 | 836 |
| 12156 | 907 |
| 12157 | 892 |
| 12158 | 914 |
| 12159 | 986 |
| 12160 | 984 |
| 12161 | 1046 |
| 12162 | 1106 |
| 12163 | 1121 |
| 12164 | 1131 |
| 12165 | 1139 |
| 12166 | 1199 |
| 12167 | 1282 |
| 12168 | 1313 |
| 12169 | 1348 |
| 12170 | 1399 |
| 12171 | 1428 |
| 12172 | 1450 |
| 12173 | 1451 |
| 12174 | 1457 |
| 12175 | 1463 |
| 12176 | 1463 |
| 12177 | 1471 |
| 12178 | 1469 |
| 12179 | 1474 |
| 12180 | 1500 |
| 12181 | 1523 |
| 12182 | 1538 |
| 12183 | 1518 |
| 12184 | 1454 |
| 12185 | 1388 |
| 12186 | 1332 |
| 12187 | 1273 |
| 12188 | 1201 |
| 12189 | 1145 |
| 12190 | 1084 |
| 12191 | 1034 |
| 12192 | 955 |
| 12193 | 935 |
| 12194 | 894 |
| 12195 | 867 |
| 12196 | 842 |
| 12197 | 826 |
| 12198 | 812 |
| 12199 | 791 |
| 12200 | 779 |
| 12201 | 766 |
| 12202 | 755 |
| 12203 | 746 |
| 12204 | 746 |
| 12205 | 736 |
| 12206 | 733 |
| 12207 | 732 |
| 12208 | 744 |
| 12209 | 746 |
| 12210 | 750 |
| 12211 | 761 |
| 12212 | 783 |
| 12213 | 766 |
| 12214 | 766 |
| 12215 | 758 |
| 12216 | 808 |
| 12217 | 831 |
| 12218 | 854 |
| 12219 | 879 |
| 12220 | 916 |
| 12221 | 943 |
| 12222 | 966 |
| 12223 | 976 |
| 12224 | 991 |
| 12225 | 1006 |
| 12226 | 1029 |
| 12227 | 1038 |
| 12228 | 1003 |
| 12229 | 987 |
| 12230 | 1019 |
| 12231 | 1040 |
| 12232 | 1077 |
| 12233 | 1064 |
| 12234 | 1075 |
| 12235 | 1128 |
| 12236 | 1145 |
| 12237 | 1174 |
| 12238 | 1135 |
| 12239 | 1069 |
| 12240 | 1074 |
| 12241 | 1061 |
| 12242 | 1014 |
| 12243 | 969 |
| 12244 | 919 |
| 12245 | 874 |
| 12246 | 982 |
| 12247 | 958 |
| 12248 | 1009 |
| 12249 | 1026 |
| 12250 | 994 |
| 12251 | 990 |
| 12252 | 985 |
| 12253 | 996 |
| 12254 | 1045 |
| 12255 | 1056 |
| 12256 | 1056 |
| 12257 | 1104 |
| 12258 | 1118 |
| 12259 | 1142 |
| 12260 | 1160 |
| 12261 | 1194 |
| 12262 | 1282 |
| 12263 | 1362 |
| 12264 | 1378 |
| 12265 | 1387 |
| 12266 | 1420 |
| 12267 | 1438 |
| 12268 | 1429 |
| 12269 | 1422 |
| 12270 | 1416 |
| 12271 | 1419 |
| 12272 | 1416 |
| 12273 | 1410 |
| 12274 | 1392 |
| 12275 | 1392 |
| 12276 | 1421 |
| 12277 | 1417 |
| 12278 | 1437 |
| 12279 | 1420 |
| 12280 | 1365 |
| 12281 | 1313 |
| 12282 | 1261 |
| 12283 | 1209 |
| 12284 | 1142 |
| 12285 | 1094 |
| 12286 | 1037 |
| 12287 | 1000 |
| 12288 | 1042 |
| 12289 | 1018 |
| 12290 | 976 |
| 12291 | 937 |
| 12292 | 906 |
| 12293 | 876 |
| 12294 | 856 |
| 12295 | 832 |
| 12296 | 816 |
| 12297 | 800 |
| 12298 | 790 |
| 12299 | 777 |
| 12300 | 768 |
| 12301 | 758 |
| 12302 | 756 |
| 12303 | 758 |
| 12304 | 768 |
| 12305 | 766 |
| 12306 | 769 |
| 12307 | 776 |
| 12308 | 780 |
| 12309 | 754 |
| 12310 | 745 |
| 12311 | 721 |
| 12312 | 739 |
| 12313 | 740 |
| 12314 | 745 |
| 12315 | 743 |
| 12316 | 750 |
| 12317 | 749 |
| 12318 | 763 |
| 12319 | 769 |
| 12320 | 782 |
| 12321 | 790 |
| 12322 | 761 |
| 12323 | 745 |
| 12324 | 730 |
| 12325 | 763 |
| 12326 | 749 |
| 12327 | 756 |
| 12328 | 717 |
| 12329 | 806 |
| 12330 | 916 |
| 12331 | 987 |
| 12332 | 1005 |
| 12333 | 871 |
| 12334 | 900 |
| 12335 | 971 |
| 12336 | 935 |
| 12337 | 790 |
| 12338 | 684 |
| 12339 | 761 |
| 12340 | 800 |
| 12341 | 737 |
| 12342 | 665 |
| 12343 | 608 |
| 12344 | 622 |
| 12345 | 622 |
| 12346 | 555 |
| 12347 | 581 |
| 12348 | 496 |
| 12349 | 477 |
| 12350 | 528 |
| 12351 | 520 |
| 12352 | 588 |
| 12353 | 669 |
| 12354 | 658 |
| 12355 | 616 |
| 12356 | 620 |
| 12357 | 657 |
| 12358 | 764 |
| 12359 | 857 |
| 12360 | 952 |
| 12361 | 1029 |
| 12362 | 1096 |
| 12363 | 1169 |
| 12364 | 1231 |
| 12365 | 1303 |
| 12366 | 1299 |
| 12367 | 1319 |
| 12368 | 1354 |
| 12369 | 1380 |
| 12370 | 1380 |
| 12371 | 1371 |
| 12372 | 1400 |
| 12373 | 1422 |
| 12374 | 1457 |
| 12375 | 1455 |
| 12376 | 1380 |
| 12377 | 1313 |
| 12378 | 1237 |
| 12379 | 1166 |
| 12380 | 1086 |
| 12381 | 1017 |
| 12382 | 957 |
| 12383 | 904 |
| 12384 | 892 |
| 12385 | 870 |
| 12386 | 835 |
| 12387 | 809 |
| 12388 | 788 |
| 12389 | 776 |
| 12390 | 761 |
| 12391 | 744 |
| 12392 | 739 |
| 12393 | 730 |
| 12394 | 723 |
| 12395 | 717 |
| 12396 | 725 |
| 12397 | 726 |
| 12398 | 731 |
| 12399 | 740 |
| 12400 | 776 |
| 12401 | 791 |
| 12402 | 818 |
| 12403 | 845 |
| 12404 | 891 |
| 12405 | 907 |
| 12406 | 930 |
| 12407 | 976 |
| 12408 | 1069 |
| 12409 | 1118 |
| 12410 | 1149 |
| 12411 | 1178 |
| 12412 | 1216 |
| 12413 | 1214 |
| 12414 | 1211 |
| 12415 | 1212 |
| 12416 | 1206 |
| 12417 | 1178 |
| 12418 | 1155 |
| 12419 | 1132 |
| 12420 | 1080 |
| 12421 | 1077 |
| 12422 | 1082 |
| 12423 | 1091 |
| 12424 | 1060 |
| 12425 | 1010 |
| 12426 | 957 |
| 12427 | 968 |
| 12428 | 883 |
| 12429 | 915 |
| 12430 | 882 |
| 12431 | 918 |
| 12432 | 899 |
| 12433 | 919 |
| 12434 | 855 |
| 12435 | 911 |
| 12436 | 947 |
| 12437 | 850 |
| 12438 | 889 |
| 12439 | 847 |
| 12440 | 880 |
| 12441 | 882 |
| 12442 | 789 |
| 12443 | 797 |
| 12444 | 769 |
| 12445 | 765 |
| 12446 | 756 |
| 12447 | 856 |
| 12448 | 895 |
| 12449 | 921 |
| 12450 | 888 |
| 12451 | 877 |
| 12452 | 888 |
| 12453 | 987 |
| 12454 | 1065 |
| 12455 | 1140 |
| 12456 | 1185 |
| 12457 | 1232 |
| 12458 | 1294 |
| 12459 | 1354 |
| 12460 | 1423 |
| 12461 | 1449 |
| 12462 | 1468 |
| 12463 | 1491 |
| 12464 | 1515 |
| 12465 | 1513 |
| 12466 | 1514 |
| 12467 | 1515 |
| 12468 | 1526 |
| 12469 | 1559 |
| 12470 | 1578 |
| 12471 | 1559 |
| 12472 | 1481 |
| 12473 | 1407 |
| 12474 | 1320 |
| 12475 | 1239 |
| 12476 | 1147 |
| 12477 | 1076 |
| 12478 | 1018 |
| 12479 | 966 |
| 12480 | 948 |
| 12481 | 924 |
| 12482 | 893 |
| 12483 | 871 |
| 12484 | 848 |
| 12485 | 832 |
| 12486 | 816 |
| 12487 | 805 |
| 12488 | 794 |
| 12489 | 787 |
| 12490 | 778 |
| 12491 | 776 |
| 12492 | 778 |
| 12493 | 777 |
| 12494 | 783 |
| 12495 | 790 |
| 12496 | 815 |
| 12497 | 823 |
| 12498 | 845 |
| 12499 | 869 |
| 12500 | 911 |
| 12501 | 925 |
| 12502 | 939 |
| 12503 | 978 |
| 12504 | 1072 |
| 12505 | 1122 |
| 12506 | 1156 |
| 12507 | 1194 |
| 12508 | 1251 |
| 12509 | 1264 |
| 12510 | 1262 |
| 12511 | 1279 |
| 12512 | 1323 |
| 12513 | 1304 |
| 12514 | 1256 |
| 12515 | 1216 |
| 12516 | 1188 |
| 12517 | 1137 |
| 12518 | 1102 |
| 12519 | 1092 |
| 12520 | 1114 |
| 12521 | 1090 |
| 12522 | 1027 |
| 12523 | 976 |
| 12524 | 949 |
| 12525 | 956 |
| 12526 | 973 |
| 12527 | 958 |
| 12528 | 921 |
| 12529 | 845 |
| 12530 | 780 |
| 12531 | 792 |
| 12532 | 792 |
| 12533 | 857 |
| 12534 | 886 |
| 12535 | 833 |
| 12536 | 820 |
| 12537 | 836 |
| 12538 | 884 |
| 12539 | 946 |
| 12540 | 946 |
| 12541 | 1017 |
| 12542 | 1067 |
| 12543 | 1057 |
| 12544 | 1056 |
| 12545 | 1080 |
| 12546 | 1116 |
| 12547 | 1054 |
| 12548 | 1040 |
| 12549 | 1119 |
| 12550 | 1165 |
| 12551 | 1231 |
| 12552 | 1322 |
| 12553 | 1395 |
| 12554 | 1433 |
| 12555 | 1495 |
| 12556 | 1531 |
| 12557 | 1524 |
| 12558 | 1529 |
| 12559 | 1506 |
| 12560 | 1484 |
| 12561 | 1478 |
| 12562 | 1478 |
| 12563 | 1491 |
| 12564 | 1509 |
| 12565 | 1527 |
| 12566 | 1559 |
| 12567 | 1537 |
| 12568 | 1452 |
| 12569 | 1377 |
| 12570 | 1302 |
| 12571 | 1216 |
| 12572 | 1126 |
| 12573 | 1055 |
| 12574 | 991 |
| 12575 | 944 |
| 12576 | 934 |
| 12577 | 905 |
| 12578 | 872 |
| 12579 | 844 |
| 12580 | 823 |
| 12581 | 806 |
| 12582 | 791 |
| 12583 | 776 |
| 12584 | 764 |
| 12585 | 750 |
| 12586 | 748 |
| 12587 | 746 |
| 12588 | 751 |
| 12589 | 758 |
| 12590 | 763 |
| 12591 | 770 |
| 12592 | 798 |
| 12593 | 810 |
| 12594 | 831 |
| 12595 | 859 |
| 12596 | 906 |
| 12597 | 913 |
| 12598 | 956 |
| 12599 | 989 |
| 12600 | 1079 |
| 12601 | 1133 |
| 12602 | 1173 |
| 12603 | 1198 |
| 12604 | 1230 |
| 12605 | 1264 |
| 12606 | 1274 |
| 12607 | 1264 |
| 12608 | 1269 |
| 12609 | 1247 |
| 12610 | 1241 |
| 12611 | 1219 |
| 12612 | 1178 |
| 12613 | 1172 |
| 12614 | 1185 |
| 12615 | 1169 |
| 12616 | 1121 |
| 12617 | 1085 |
| 12618 | 1084 |
| 12619 | 1081 |
| 12620 | 1090 |
| 12621 | 1013 |
| 12622 | 1053 |
| 12623 | 1125 |
| 12624 | 1053 |
| 12625 | 1023 |
| 12626 | 973 |
| 12627 | 938 |
| 12628 | 805 |
| 12629 | 750 |
| 12630 | 785 |
| 12631 | 803 |
| 12632 | 809 |
| 12633 | 768 |
| 12634 | 862 |
| 12635 | 1077 |
| 12636 | 1054 |
| 12637 | 861 |
| 12638 | 808 |
| 12639 | 793 |
| 12640 | 837 |
| 12641 | 927 |
| 12642 | 934 |
| 12643 | 982 |
| 12644 | 981 |
| 12645 | 1026 |
| 12646 | 1093 |
| 12647 | 1207 |
| 12648 | 1297 |
| 12649 | 1350 |
| 12650 | 1393 |
| 12651 | 1432 |
| 12652 | 1449 |
| 12653 | 1474 |
| 12654 | 1501 |
| 12655 | 1534 |
| 12656 | 1546 |
| 12657 | 1529 |
| 12658 | 1519 |
| 12659 | 1518 |
| 12660 | 1537 |
| 12661 | 1554 |
| 12662 | 1563 |
| 12663 | 1543 |
| 12664 | 1469 |
| 12665 | 1387 |
| 12666 | 1306 |
| 12667 | 1224 |
| 12668 | 1134 |
| 12669 | 1068 |
| 12670 | 1006 |
| 12671 | 953 |
| 12672 | 934 |
| 12673 | 911 |
| 12674 | 880 |
| 12675 | 855 |
| 12676 | 835 |
| 12677 | 815 |
| 12678 | 799 |
| 12679 | 787 |
| 12680 | 776 |
| 12681 | 765 |
| 12682 | 762 |
| 12683 | 762 |
| 12684 | 766 |
| 12685 | 766 |
| 12686 | 767 |
| 12687 | 773 |
| 12688 | 794 |
| 12689 | 805 |
| 12690 | 831 |
| 12691 | 859 |
| 12692 | 900 |
| 12693 | 895 |
| 12694 | 930 |
| 12695 | 959 |
| 12696 | 1052 |
| 12697 | 1102 |
| 12698 | 1141 |
| 12699 | 1172 |
| 12700 | 1214 |
| 12701 | 1207 |
| 12702 | 1221 |
| 12703 | 1273 |
| 12704 | 1284 |
| 12705 | 1272 |
| 12706 | 1257 |
| 12707 | 1225 |
| 12708 | 1156 |
| 12709 | 1122 |
| 12710 | 1103 |
| 12711 | 1104 |
| 12712 | 1135 |
| 12713 | 1147 |
| 12714 | 1135 |
| 12715 | 1149 |
| 12716 | 1178 |
| 12717 | 1180 |
| 12718 | 1246 |
| 12719 | 1275 |
| 12720 | 1228 |
| 12721 | 1154 |
| 12722 | 1096 |
| 12723 | 1032 |
| 12724 | 1078 |
| 12725 | 1005 |
| 12726 | 983 |
| 12727 | 993 |
| 12728 | 977 |
| 12729 | 893 |
| 12730 | 874 |
| 12731 | 925 |
| 12732 | 931 |
| 12733 | 907 |
| 12734 | 935 |
| 12735 | 959 |
| 12736 | 988 |
| 12737 | 1028 |
| 12738 | 1095 |
| 12739 | 1087 |
| 12740 | 1110 |
| 12741 | 1187 |
| 12742 | 1250 |
| 12743 | 1324 |
| 12744 | 1417 |
| 12745 | 1489 |
| 12746 | 1557 |
| 12747 | 1584 |
| 12748 | 1584 |
| 12749 | 1597 |
| 12750 | 1605 |
| 12751 | 1624 |
| 12752 | 1627 |
| 12753 | 1600 |
| 12754 | 1549 |
| 12755 | 1552 |
| 12756 | 1554 |
| 12757 | 1561 |
| 12758 | 1554 |
| 12759 | 1518 |
| 12760 | 1435 |
| 12761 | 1355 |
| 12762 | 1276 |
| 12763 | 1192 |
| 12764 | 1108 |
| 12765 | 1040 |
| 12766 | 994 |
| 12767 | 950 |
| 12768 | 930 |
| 12769 | 905 |
| 12770 | 870 |
| 12771 | 849 |
| 12772 | 825 |
| 12773 | 811 |
| 12774 | 794 |
| 12775 | 774 |
| 12776 | 771 |
| 12777 | 756 |
| 12778 | 748 |
| 12779 | 748 |
| 12780 | 751 |
| 12781 | 749 |
| 12782 | 748 |
| 12783 | 752 |
| 12784 | 779 |
| 12785 | 786 |
| 12786 | 803 |
| 12787 | 825 |
| 12788 | 874 |
| 12789 | 876 |
| 12790 | 904 |
| 12791 | 938 |
| 12792 | 1034 |
| 12793 | 1089 |
| 12794 | 1141 |
| 12795 | 1190 |
| 12796 | 1240 |
| 12797 | 1237 |
| 12798 | 1233 |
| 12799 | 1277 |
| 12800 | 1353 |
| 12801 | 1355 |
| 12802 | 1314 |
| 12803 | 1286 |
| 12804 | 1303 |
| 12805 | 1242 |
| 12806 | 1203 |
| 12807 | 1238 |
| 12808 | 1282 |
| 12809 | 1301 |
| 12810 | 1318 |
| 12811 | 1301 |
| 12812 | 1298 |
| 12813 | 1328 |
| 12814 | 1294 |
| 12815 | 1151 |
| 12816 | 1043 |
| 12817 | 1022 |
| 12818 | 927 |
| 12819 | 872 |
| 12820 | 861 |
| 12821 | 803 |
| 12822 | 811 |
| 12823 | 845 |
| 12824 | 936 |
| 12825 | 889 |
| 12826 | 757 |
| 12827 | 746 |
| 12828 | 834 |
| 12829 | 719 |
| 12830 | 723 |
| 12831 | 845 |
| 12832 | 854 |
| 12833 | 899 |
| 12834 | 969 |
| 12835 | 1001 |
| 12836 | 1006 |
| 12837 | 1012 |
| 12838 | 1046 |
| 12839 | 1130 |
| 12840 | 1168 |
| 12841 | 1211 |
| 12842 | 1269 |
| 12843 | 1312 |
| 12844 | 1356 |
| 12845 | 1365 |
| 12846 | 1380 |
| 12847 | 1396 |
| 12848 | 1405 |
| 12849 | 1428 |
| 12850 | 1436 |
| 12851 | 1439 |
| 12852 | 1452 |
| 12853 | 1492 |
| 12854 | 1509 |
| 12855 | 1499 |
| 12856 | 1467 |
| 12857 | 1401 |
| 12858 | 1342 |
| 12859 | 1278 |
| 12860 | 1206 |
| 12861 | 1143 |
| 12862 | 1083 |
| 12863 | 1026 |
| 12864 | 1002 |
| 12865 | 977 |
| 12866 | 938 |
| 12867 | 909 |
| 12868 | 888 |
| 12869 | 865 |
| 12870 | 849 |
| 12871 | 829 |
| 12872 | 814 |
| 12873 | 803 |
| 12874 | 790 |
| 12875 | 781 |
| 12876 | 780 |
| 12877 | 775 |
| 12878 | 772 |
| 12879 | 771 |
| 12880 | 783 |
| 12881 | 783 |
| 12882 | 793 |
| 12883 | 801 |
| 12884 | 813 |
| 12885 | 792 |
| 12886 | 790 |
| 12887 | 792 |
| 12888 | 836 |
| 12889 | 848 |
| 12890 | 868 |
| 12891 | 890 |
| 12892 | 937 |
| 12893 | 964 |
| 12894 | 991 |
| 12895 | 1016 |
| 12896 | 1032 |
| 12897 | 1018 |
| 12898 | 1057 |
| 12899 | 1089 |
| 12900 | 1056 |
| 12901 | 1055 |
| 12902 | 1097 |
| 12903 | 1173 |
| 12904 | 1239 |
| 12905 | 1187 |
| 12906 | 1176 |
| 12907 | 1168 |
| 12908 | 1142 |
| 12909 | 1157 |
| 12910 | 1076 |
| 12911 | 994 |
| 12912 | 969 |
| 12913 | 983 |
| 12914 | 1010 |
| 12915 | 980 |
| 12916 | 888 |
| 12917 | 806 |
| 12918 | 897 |
| 12919 | 885 |
| 12920 | 847 |
| 12921 | 867 |
| 12922 | 880 |
| 12923 | 945 |
| 12924 | 952 |
| 12925 | 927 |
| 12926 | 946 |
| 12927 | 947 |
| 12928 | 937 |
| 12929 | 974 |
| 12930 | 1002 |
| 12931 | 1041 |
| 12932 | 1058 |
| 12933 | 1117 |
| 12934 | 1227 |
| 12935 | 1298 |
| 12936 | 1315 |
| 12937 | 1337 |
| 12938 | 1359 |
| 12939 | 1396 |
| 12940 | 1417 |
| 12941 | 1418 |
| 12942 | 1424 |
| 12943 | 1426 |
| 12944 | 1424 |
| 12945 | 1416 |
| 12946 | 1407 |
| 12947 | 1406 |
| 12948 | 1411 |
| 12949 | 1401 |
| 12950 | 1429 |
| 12951 | 1440 |
| 12952 | 1386 |
| 12953 | 1333 |
| 12954 | 1281 |
| 12955 | 1233 |
| 12956 | 1166 |
| 12957 | 1123 |
| 12958 | 1063 |
| 12959 | 1021 |
| 12960 | 843 |
| 12961 | 818 |
| 12962 | 784 |
| 12963 | 753 |
| 12964 | 731 |
| 12965 | 707 |
| 12966 | 691 |
| 12967 | 674 |
| 12968 | 660 |
| 12969 | 647 |
| 12970 | 637 |
| 12971 | 630 |
| 12972 | 623 |
| 12973 | 614 |
| 12974 | 613 |
| 12975 | 618 |
| 12976 | 624 |
| 12977 | 624 |
| 12978 | 627 |
| 12979 | 630 |
| 12980 | 623 |
| 12981 | 603 |
| 12982 | 600 |
| 12983 | 587 |
| 12984 | 603 |
| 12985 | 601 |
| 12986 | 605 |
| 12987 | 602 |
| 12988 | 605 |
| 12989 | 602 |
| 12990 | 612 |
| 12991 | 620 |
| 12992 | 632 |
| 12993 | 643 |
| 12994 | 617 |
| 12995 | 605 |
| 12996 | 590 |
| 12997 | 617 |
| 12998 | 606 |
| 12999 | 612 |
| 13000 | 571 |
| 13001 | 631 |
| 13002 | 714 |
| 13003 | 753 |
| 13004 | 732 |
| 13005 | 616 |
| 13006 | 643 |
| 13007 | 687 |
| 13008 | 682 |
| 13009 | 581 |
| 13010 | 527 |
| 13011 | 582 |
| 13012 | 625 |
| 13013 | 545 |
| 13014 | 491 |
| 13015 | 482 |
| 13016 | 517 |
| 13017 | 539 |
| 13018 | 468 |
| 13019 | 442 |
| 13020 | 418 |
| 13021 | 446 |
| 13022 | 445 |
| 13023 | 450 |
| 13024 | 506 |
| 13025 | 568 |
| 13026 | 577 |
| 13027 | 552 |
| 13028 | 586 |
| 13029 | 611 |
| 13030 | 670 |
| 13031 | 718 |
| 13032 | 776 |
| 13033 | 846 |
| 13034 | 911 |
| 13035 | 970 |
| 13036 | 1016 |
| 13037 | 1065 |
| 13038 | 1067 |
| 13039 | 1089 |
| 13040 | 1108 |
| 13041 | 1119 |
| 13042 | 1117 |
| 13043 | 1107 |
| 13044 | 1112 |
| 13045 | 1118 |
| 13046 | 1152 |
| 13047 | 1167 |
| 13048 | 1112 |
| 13049 | 1060 |
| 13050 | 1002 |
| 13051 | 942 |
| 13052 | 881 |
| 13053 | 825 |
| 13054 | 775 |
| 13055 | 736 |
| 13056 | 883 |
| 13057 | 855 |
| 13058 | 819 |
| 13059 | 787 |
| 13060 | 766 |
| 13061 | 742 |
| 13062 | 725 |
| 13063 | 710 |
| 13064 | 696 |
| 13065 | 683 |
| 13066 | 672 |
| 13067 | 666 |
| 13068 | 660 |
| 13069 | 652 |
| 13070 | 650 |
| 13071 | 654 |
| 13072 | 659 |
| 13073 | 658 |
| 13074 | 661 |
| 13075 | 662 |
| 13076 | 652 |
| 13077 | 633 |
| 13078 | 634 |
| 13079 | 622 |
| 13080 | 638 |
| 13081 | 633 |
| 13082 | 636 |
| 13083 | 635 |
| 13084 | 642 |
| 13085 | 641 |
| 13086 | 652 |
| 13087 | 658 |
| 13088 | 669 |
| 13089 | 682 |
| 13090 | 662 |
| 13091 | 646 |
| 13092 | 617 |
| 13093 | 617 |
| 13094 | 602 |
| 13095 | 589 |
| 13096 | 560 |
| 13097 | 594 |
| 13098 | 642 |
| 13099 | 666 |
| 13100 | 670 |
| 13101 | 615 |
| 13102 | 642 |
| 13103 | 671 |
| 13104 | 670 |
| 13105 | 597 |
| 13106 | 593 |
| 13107 | 623 |
| 13108 | 623 |
| 13109 | 575 |
| 13110 | 556 |
| 13111 | 572 |
| 13112 | 561 |
| 13113 | 563 |
| 13114 | 516 |
| 13115 | 465 |
| 13116 | 437 |
| 13117 | 471 |
| 13118 | 474 |
| 13119 | 476 |
| 13120 | 519 |
| 13121 | 583 |
| 13122 | 614 |
| 13123 | 626 |
| 13124 | 690 |
| 13125 | 719 |
| 13126 | 764 |
| 13127 | 803 |
| 13128 | 855 |
| 13129 | 917 |
| 13130 | 979 |
| 13131 | 1027 |
| 13132 | 1059 |
| 13133 | 1094 |
| 13134 | 1113 |
| 13135 | 1139 |
| 13136 | 1161 |
| 13137 | 1173 |
| 13138 | 1172 |
| 13139 | 1163 |
| 13140 | 1169 |
| 13141 | 1171 |
| 13142 | 1202 |
| 13143 | 1225 |
| 13144 | 1170 |
| 13145 | 1117 |
| 13146 | 1060 |
| 13147 | 996 |
| 13148 | 930 |
| 13149 | 872 |
| 13150 | 820 |
| 13151 | 778 |
| 13152 | 852 |
| 13153 | 826 |
| 13154 | 796 |
| 13155 | 772 |
| 13156 | 755 |
| 13157 | 743 |
| 13158 | 728 |
| 13159 | 710 |
| 13160 | 706 |
| 13161 | 700 |
| 13162 | 694 |
| 13163 | 686 |
| 13164 | 692 |
| 13165 | 692 |
| 13166 | 697 |
| 13167 | 704 |
| 13168 | 737 |
| 13169 | 750 |
| 13170 | 772 |
| 13171 | 805 |
| 13172 | 853 |
| 13173 | 858 |
| 13174 | 886 |
| 13175 | 939 |
| 13176 | 1041 |
| 13177 | 1095 |
| 13178 | 1133 |
| 13179 | 1172 |
| 13180 | 1227 |
| 13181 | 1250 |
| 13182 | 1259 |
| 13183 | 1278 |
| 13184 | 1285 |
| 13185 | 1268 |
| 13186 | 1247 |
| 13187 | 1247 |
| 13188 | 1227 |
| 13189 | 1231 |
| 13190 | 1272 |
| 13191 | 1275 |
| 13192 | 1267 |
| 13193 | 1268 |
| 13194 | 1237 |
| 13195 | 1261 |
| 13196 | 1191 |
| 13197 | 1216 |
| 13198 | 1193 |
| 13199 | 1223 |
| 13200 | 1191 |
| 13201 | 1159 |
| 13202 | 1047 |
| 13203 | 1075 |
| 13204 | 1110 |
| 13205 | 1035 |
| 13206 | 1044 |
| 13207 | 988 |
| 13208 | 1020 |
| 13209 | 1025 |
| 13210 | 933 |
| 13211 | 941 |
| 13212 | 909 |
| 13213 | 872 |
| 13214 | 858 |
| 13215 | 961 |
| 13216 | 1005 |
| 13217 | 1013 |
| 13218 | 1009 |
| 13219 | 1015 |
| 13220 | 1036 |
| 13221 | 1126 |
| 13222 | 1191 |
| 13223 | 1254 |
| 13224 | 1270 |
| 13225 | 1283 |
| 13226 | 1310 |
| 13227 | 1360 |
| 13228 | 1441 |
| 13229 | 1490 |
| 13230 | 1508 |
| 13231 | 1526 |
| 13232 | 1535 |
| 13233 | 1525 |
| 13234 | 1518 |
| 13235 | 1504 |
| 13236 | 1503 |
| 13237 | 1528 |
| 13238 | 1542 |
| 13239 | 1520 |
| 13240 | 1448 |
| 13241 | 1382 |
| 13242 | 1297 |
| 13243 | 1218 |
| 13244 | 1129 |
| 13245 | 1063 |
| 13246 | 1007 |
| 13247 | 955 |
| 13248 | 937 |
| 13249 | 908 |
| 13250 | 878 |
| 13251 | 854 |
| 13252 | 834 |
| 13253 | 819 |
| 13254 | 804 |
| 13255 | 792 |
| 13256 | 783 |
| 13257 | 770 |
| 13258 | 770 |
| 13259 | 768 |
| 13260 | 770 |
| 13261 | 769 |
| 13262 | 775 |
| 13263 | 780 |
| 13264 | 798 |
| 13265 | 808 |
| 13266 | 829 |
| 13267 | 853 |
| 13268 | 893 |
| 13269 | 888 |
| 13270 | 916 |
| 13271 | 949 |
| 13272 | 1033 |
| 13273 | 1074 |
| 13274 | 1116 |
| 13275 | 1160 |
| 13276 | 1191 |
| 13277 | 1201 |
| 13278 | 1182 |
| 13279 | 1162 |
| 13280 | 1157 |
| 13281 | 1135 |
| 13282 | 1138 |
| 13283 | 1110 |
| 13284 | 1058 |
| 13285 | 1048 |
| 13286 | 1059 |
| 13287 | 1056 |
| 13288 | 977 |
| 13289 | 906 |
| 13290 | 889 |
| 13291 | 917 |
| 13292 | 918 |
| 13293 | 831 |
| 13294 | 933 |
| 13295 | 1011 |
| 13296 | 864 |
| 13297 | 847 |
| 13298 | 807 |
| 13299 | 749 |
| 13300 | 729 |
| 13301 | 806 |
| 13302 | 823 |
| 13303 | 829 |
| 13304 | 816 |
| 13305 | 806 |
| 13306 | 839 |
| 13307 | 956 |
| 13308 | 950 |
| 13309 | 858 |
| 13310 | 881 |
| 13311 | 842 |
| 13312 | 834 |
| 13313 | 893 |
| 13314 | 968 |
| 13315 | 1021 |
| 13316 | 1046 |
| 13317 | 1093 |
| 13318 | 1142 |
| 13319 | 1259 |
| 13320 | 1343 |
| 13321 | 1398 |
| 13322 | 1436 |
| 13323 | 1435 |
| 13324 | 1431 |
| 13325 | 1441 |
| 13326 | 1464 |
| 13327 | 1482 |
| 13328 | 1487 |
| 13329 | 1484 |
| 13330 | 1478 |
| 13331 | 1473 |
| 13332 | 1479 |
| 13333 | 1478 |
| 13334 | 1508 |
| 13335 | 1497 |
| 13336 | 1432 |
| 13337 | 1359 |
| 13338 | 1284 |
| 13339 | 1205 |
| 13340 | 1119 |
| 13341 | 1054 |
| 13342 | 995 |
| 13343 | 942 |
| 13344 | 915 |
| 13345 | 888 |
| 13346 | 857 |
| 13347 | 832 |
| 13348 | 811 |
| 13349 | 791 |
| 13350 | 777 |
| 13351 | 761 |
| 13352 | 751 |
| 13353 | 741 |
| 13354 | 742 |
| 13355 | 741 |
| 13356 | 742 |
| 13357 | 744 |
| 13358 | 747 |
| 13359 | 756 |
| 13360 | 774 |
| 13361 | 785 |
| 13362 | 817 |
| 13363 | 841 |
| 13364 | 873 |
| 13365 | 862 |
| 13366 | 899 |
| 13367 | 935 |
| 13368 | 1024 |
| 13369 | 1072 |
| 13370 | 1110 |
| 13371 | 1134 |
| 13372 | 1186 |
| 13373 | 1186 |
| 13374 | 1212 |
| 13375 | 1241 |
| 13376 | 1255 |
| 13377 | 1250 |
| 13378 | 1230 |
| 13379 | 1198 |
| 13380 | 1123 |
| 13381 | 1072 |
| 13382 | 1048 |
| 13383 | 1017 |
| 13384 | 1009 |
| 13385 | 1026 |
| 13386 | 1003 |
| 13387 | 970 |
| 13388 | 986 |
| 13389 | 983 |
| 13390 | 1022 |
| 13391 | 1024 |
| 13392 | 981 |
| 13393 | 982 |
| 13394 | 1032 |
| 13395 | 983 |
| 13396 | 946 |
| 13397 | 863 |
| 13398 | 816 |
| 13399 | 838 |
| 13400 | 845 |
| 13401 | 833 |
| 13402 | 810 |
| 13403 | 829 |
| 13404 | 856 |
| 13405 | 825 |
| 13406 | 834 |
| 13407 | 884 |
| 13408 | 891 |
| 13409 | 911 |
| 13410 | 964 |
| 13411 | 945 |
| 13412 | 998 |
| 13413 | 1077 |
| 13414 | 1130 |
| 13415 | 1192 |
| 13416 | 1272 |
| 13417 | 1350 |
| 13418 | 1453 |
| 13419 | 1490 |
| 13420 | 1489 |
| 13421 | 1507 |
| 13422 | 1527 |
| 13423 | 1552 |
| 13424 | 1572 |
| 13425 | 1550 |
| 13426 | 1479 |
| 13427 | 1474 |
| 13428 | 1471 |
| 13429 | 1494 |
| 13430 | 1495 |
| 13431 | 1472 |
| 13432 | 1412 |
| 13433 | 1338 |
| 13434 | 1259 |
| 13435 | 1179 |
| 13436 | 1096 |
| 13437 | 1033 |
| 13438 | 985 |
| 13439 | 953 |
| 13440 | 928 |
| 13441 | 904 |
| 13442 | 871 |
| 13443 | 849 |
| 13444 | 830 |
| 13445 | 818 |
| 13446 | 802 |
| 13447 | 785 |
| 13448 | 784 |
| 13449 | 771 |
| 13450 | 764 |
| 13451 | 764 |
| 13452 | 764 |
| 13453 | 766 |
| 13454 | 766 |
| 13455 | 772 |
| 13456 | 792 |
| 13457 | 798 |
| 13458 | 817 |
| 13459 | 836 |
| 13460 | 874 |
| 13461 | 872 |
| 13462 | 898 |
| 13463 | 937 |
| 13464 | 1019 |
| 13465 | 1070 |
| 13466 | 1123 |
| 13467 | 1192 |
| 13468 | 1230 |
| 13469 | 1200 |
| 13470 | 1200 |
| 13471 | 1224 |
| 13472 | 1288 |
| 13473 | 1322 |
| 13474 | 1311 |
| 13475 | 1286 |
| 13476 | 1293 |
| 13477 | 1271 |
| 13478 | 1262 |
| 13479 | 1282 |
| 13480 | 1289 |
| 13481 | 1287 |
| 13482 | 1254 |
| 13483 | 1238 |
| 13484 | 1204 |
| 13485 | 1192 |
| 13486 | 1172 |
| 13487 | 1102 |
| 13488 | 1022 |
| 13489 | 1032 |
| 13490 | 974 |
| 13491 | 865 |
| 13492 | 779 |
| 13493 | 708 |
| 13494 | 723 |
| 13495 | 744 |
| 13496 | 860 |
| 13497 | 889 |
| 13498 | 794 |
| 13499 | 779 |
| 13500 | 781 |
| 13501 | 644 |
| 13502 | 670 |
| 13503 | 743 |
| 13504 | 770 |
| 13505 | 794 |
| 13506 | 833 |
| 13507 | 894 |
| 13508 | 938 |
| 13509 | 971 |
| 13510 | 1027 |
| 13511 | 1103 |
| 13512 | 1138 |
| 13513 | 1163 |
| 13514 | 1210 |
| 13515 | 1256 |
| 13516 | 1288 |
| 13517 | 1299 |
| 13518 | 1316 |
| 13519 | 1344 |
| 13520 | 1365 |
| 13521 | 1390 |
| 13522 | 1392 |
| 13523 | 1394 |
| 13524 | 1407 |
| 13525 | 1416 |
| 13526 | 1443 |
| 13527 | 1445 |
| 13528 | 1450 |
| 13529 | 1400 |
| 13530 | 1342 |
| 13531 | 1281 |
| 13532 | 1209 |
| 13533 | 1146 |
| 13534 | 1086 |
| 13535 | 1032 |
| 13536 | 1003 |
| 13537 | 974 |
| 13538 | 934 |
| 13539 | 902 |
| 13540 | 880 |
| 13541 | 857 |
| 13542 | 839 |
| 13543 | 817 |
| 13544 | 801 |
| 13545 | 791 |
| 13546 | 781 |
| 13547 | 773 |
| 13548 | 774 |
| 13549 | 771 |
| 13550 | 766 |
| 13551 | 766 |
| 13552 | 777 |
| 13553 | 773 |
| 13554 | 784 |
| 13555 | 789 |
| 13556 | 787 |
| 13557 | 769 |
| 13558 | 778 |
| 13559 | 786 |
| 13560 | 821 |
| 13561 | 828 |
| 13562 | 839 |
| 13563 | 850 |
| 13564 | 889 |
| 13565 | 907 |
| 13566 | 922 |
| 13567 | 940 |
| 13568 | 942 |
| 13569 | 914 |
| 13570 | 936 |
| 13571 | 967 |
| 13572 | 968 |
| 13573 | 977 |
| 13574 | 1012 |
| 13575 | 1060 |
| 13576 | 1062 |
| 13577 | 999 |
| 13578 | 983 |
| 13579 | 969 |
| 13580 | 950 |
| 13581 | 930 |
| 13582 | 866 |
| 13583 | 839 |
| 13584 | 836 |
| 13585 | 886 |
| 13586 | 924 |
| 13587 | 890 |
| 13588 | 832 |
| 13589 | 701 |
| 13590 | 687 |
| 13591 | 648 |
| 13592 | 572 |
| 13593 | 551 |
| 13594 | 569 |
| 13595 | 641 |
| 13596 | 694 |
| 13597 | 672 |
| 13598 | 679 |
| 13599 | 690 |
| 13600 | 689 |
| 13601 | 754 |
| 13602 | 785 |
| 13603 | 825 |
| 13604 | 856 |
| 13605 | 908 |
| 13606 | 1003 |
| 13607 | 1077 |
| 13608 | 1098 |
| 13609 | 1152 |
| 13610 | 1180 |
| 13611 | 1240 |
| 13612 | 1271 |
| 13613 | 1269 |
| 13614 | 1289 |
| 13615 | 1310 |
| 13616 | 1328 |
| 13617 | 1331 |
| 13618 | 1323 |
| 13619 | 1328 |
| 13620 | 1328 |
| 13621 | 1329 |
| 13622 | 1366 |
| 13623 | 1404 |
| 13624 | 1360 |
| 13625 | 1315 |
| 13626 | 1266 |
| 13627 | 1221 |
| 13628 | 1156 |
| 13629 | 1114 |
| 13630 | 1059 |
| 13631 | 1004 |
| 13632 | 973 |
| 13633 | 939 |
| 13634 | 899 |
| 13635 | 865 |
| 13636 | 844 |
| 13637 | 820 |
| 13638 | 800 |
| 13639 | 786 |
| 13640 | 772 |
| 13641 | 758 |
| 13642 | 746 |
| 13643 | 741 |
| 13644 | 737 |
| 13645 | 730 |
| 13646 | 726 |
| 13647 | 728 |
| 13648 | 732 |
| 13649 | 731 |
| 13650 | 733 |
| 13651 | 733 |
| 13652 | 717 |
| 13653 | 699 |
| 13654 | 704 |
| 13655 | 693 |
| 13656 | 710 |
| 13657 | 701 |
| 13658 | 703 |
| 13659 | 705 |
| 13660 | 718 |
| 13661 | 719 |
| 13662 | 730 |
| 13663 | 735 |
| 13664 | 745 |
| 13665 | 761 |
| 13666 | 746 |
| 13667 | 727 |
| 13668 | 679 |
| 13669 | 646 |
| 13670 | 626 |
| 13671 | 590 |
| 13672 | 573 |
| 13673 | 579 |
| 13674 | 587 |
| 13675 | 595 |
| 13676 | 629 |
| 13677 | 644 |
| 13678 | 672 |
| 13679 | 686 |
| 13680 | 687 |
| 13681 | 645 |
| 13682 | 701 |
| 13683 | 701 |
| 13684 | 651 |
| 13685 | 639 |
| 13686 | 661 |
| 13687 | 707 |
| 13688 | 641 |
| 13689 | 619 |
| 13690 | 598 |
| 13691 | 515 |
| 13692 | 480 |
| 13693 | 523 |
| 13694 | 530 |
| 13695 | 531 |
| 13696 | 559 |
| 13697 | 628 |
| 13698 | 687 |
| 13699 | 745 |
| 13700 | 847 |
| 13701 | 883 |
| 13702 | 911 |
| 13703 | 943 |
| 13704 | 990 |
| 13705 | 1045 |
| 13706 | 1107 |
| 13707 | 1143 |
| 13708 | 1162 |
| 13709 | 1181 |
| 13710 | 1221 |
| 13711 | 1253 |
| 13712 | 1280 |
| 13713 | 1294 |
| 13714 | 1293 |
| 13715 | 1286 |
| 13716 | 1292 |
| 13717 | 1289 |
| 13718 | 1319 |
| 13719 | 1354 |
| 13720 | 1295 |
| 13721 | 1238 |
| 13722 | 1180 |
| 13723 | 1109 |
| 13724 | 1033 |
| 13725 | 970 |
| 13726 | 913 |
| 13727 | 865 |
| 13728 | 840 |
| 13729 | 816 |
| 13730 | 786 |
| 13731 | 765 |
| 13732 | 748 |
| 13733 | 736 |
| 13734 | 722 |
| 13735 | 708 |
| 13736 | 703 |
| 13737 | 696 |
| 13738 | 693 |
| 13739 | 688 |
| 13740 | 691 |
| 13741 | 690 |
| 13742 | 693 |
| 13743 | 697 |
| 13744 | 726 |
| 13745 | 739 |
| 13746 | 763 |
| 13747 | 789 |
| 13748 | 828 |
| 13749 | 833 |
| 13750 | 869 |
| 13751 | 919 |
| 13752 | 1012 |
| 13753 | 1064 |
| 13754 | 1100 |
| 13755 | 1138 |
| 13756 | 1202 |
| 13757 | 1224 |
| 13758 | 1232 |
| 13759 | 1250 |
| 13760 | 1257 |
| 13761 | 1245 |
| 13762 | 1212 |
| 13763 | 1191 |
| 13764 | 1169 |
| 13765 | 1127 |
| 13766 | 1123 |
| 13767 | 1100 |
| 13768 | 1089 |
| 13769 | 1088 |
| 13770 | 1075 |
| 13771 | 1058 |
| 13772 | 1066 |
| 13773 | 1083 |
| 13774 | 1100 |
| 13775 | 1100 |
| 13776 | 1110 |
| 13777 | 1092 |
| 13778 | 1019 |
| 13779 | 1002 |
| 13780 | 984 |
| 13781 | 937 |
| 13782 | 916 |
| 13783 | 956 |
| 13784 | 943 |
| 13785 | 908 |
| 13786 | 882 |
| 13787 | 884 |
| 13788 | 873 |
| 13789 | 848 |
| 13790 | 848 |
| 13791 | 891 |
| 13792 | 884 |
| 13793 | 873 |
| 13794 | 896 |
| 13795 | 952 |
| 13796 | 990 |
| 13797 | 1063 |
| 13798 | 1133 |
| 13799 | 1177 |
| 13800 | 1196 |
| 13801 | 1220 |
| 13802 | 1260 |
| 13803 | 1299 |
| 13804 | 1352 |
| 13805 | 1397 |
| 13806 | 1429 |
| 13807 | 1459 |
| 13808 | 1470 |
| 13809 | 1464 |
| 13810 | 1459 |
| 13811 | 1451 |
| 13812 | 1448 |
| 13813 | 1451 |
| 13814 | 1461 |
| 13815 | 1462 |
| 13816 | 1410 |
| 13817 | 1352 |
| 13818 | 1277 |
| 13819 | 1197 |
| 13820 | 1116 |
| 13821 | 1055 |
| 13822 | 995 |
| 13823 | 943 |
| 13824 | 917 |
| 13825 | 885 |
| 13826 | 856 |
| 13827 | 832 |
| 13828 | 814 |
| 13829 | 797 |
| 13830 | 780 |
| 13831 | 778 |
| 13832 | 771 |
| 13833 | 762 |
| 13834 | 757 |
| 13835 | 756 |
| 13836 | 757 |
| 13837 | 757 |
| 13838 | 761 |
| 13839 | 768 |
| 13840 | 787 |
| 13841 | 792 |
| 13842 | 813 |
| 13843 | 835 |
| 13844 | 866 |
| 13845 | 866 |
| 13846 | 894 |
| 13847 | 937 |
| 13848 | 1020 |
| 13849 | 1073 |
| 13850 | 1100 |
| 13851 | 1127 |
| 13852 | 1190 |
| 13853 | 1215 |
| 13854 | 1219 |
| 13855 | 1221 |
| 13856 | 1222 |
| 13857 | 1214 |
| 13858 | 1196 |
| 13859 | 1171 |
| 13860 | 1119 |
| 13861 | 1096 |
| 13862 | 1096 |
| 13863 | 1075 |
| 13864 | 1070 |
| 13865 | 1055 |
| 13866 | 1040 |
| 13867 | 1009 |
| 13868 | 996 |
| 13869 | 1009 |
| 13870 | 1008 |
| 13871 | 1005 |
| 13872 | 1005 |
| 13873 | 976 |
| 13874 | 934 |
| 13875 | 918 |
| 13876 | 887 |
| 13877 | 895 |
| 13878 | 898 |
| 13879 | 889 |
| 13880 | 920 |
| 13881 | 905 |
| 13882 | 891 |
| 13883 | 884 |
| 13884 | 873 |
| 13885 | 860 |
| 13886 | 899 |
| 13887 | 886 |
| 13888 | 890 |
| 13889 | 896 |
| 13890 | 940 |
| 13891 | 1029 |
| 13892 | 1109 |
| 13893 | 1219 |
| 13894 | 1318 |
| 13895 | 1389 |
| 13896 | 1433 |
| 13897 | 1471 |
| 13898 | 1502 |
| 13899 | 1522 |
| 13900 | 1503 |
| 13901 | 1478 |
| 13902 | 1483 |
| 13903 | 1484 |
| 13904 | 1472 |
| 13905 | 1457 |
| 13906 | 1437 |
| 13907 | 1442 |
| 13908 | 1441 |
| 13909 | 1442 |
| 13910 | 1456 |
| 13911 | 1458 |
| 13912 | 1397 |
| 13913 | 1330 |
| 13914 | 1259 |
| 13915 | 1177 |
| 13916 | 1096 |
| 13917 | 1031 |
| 13918 | 974 |
| 13919 | 933 |
| 13920 | 920 |
| 13921 | 890 |
| 13922 | 857 |
| 13923 | 836 |
| 13924 | 816 |
| 13925 | 801 |
| 13926 | 785 |
| 13927 | 775 |
| 13928 | 767 |
| 13929 | 756 |
| 13930 | 756 |
| 13931 | 755 |
| 13932 | 756 |
| 13933 | 755 |
| 13934 | 756 |
| 13935 | 760 |
| 13936 | 779 |
| 13937 | 791 |
| 13938 | 811 |
| 13939 | 829 |
| 13940 | 856 |
| 13941 | 856 |
| 13942 | 886 |
| 13943 | 918 |
| 13944 | 1003 |
| 13945 | 1038 |
| 13946 | 1084 |
| 13947 | 1128 |
| 13948 | 1157 |
| 13949 | 1164 |
| 13950 | 1154 |
| 13951 | 1131 |
| 13952 | 1129 |
| 13953 | 1118 |
| 13954 | 1114 |
| 13955 | 1074 |
| 13956 | 1030 |
| 13957 | 994 |
| 13958 | 962 |
| 13959 | 932 |
| 13960 | 858 |
| 13961 | 775 |
| 13962 | 739 |
| 13963 | 789 |
| 13964 | 790 |
| 13965 | 776 |
| 13966 | 865 |
| 13967 | 919 |
| 13968 | 832 |
| 13969 | 816 |
| 13970 | 816 |
| 13971 | 803 |
| 13972 | 836 |
| 13973 | 883 |
| 13974 | 941 |
| 13975 | 930 |
| 13976 | 875 |
| 13977 | 902 |
| 13978 | 861 |
| 13979 | 877 |
| 13980 | 889 |
| 13981 | 916 |
| 13982 | 954 |
| 13983 | 958 |
| 13984 | 932 |
| 13985 | 1037 |
| 13986 | 1115 |
| 13987 | 1187 |
| 13988 | 1211 |
| 13989 | 1247 |
| 13990 | 1287 |
| 13991 | 1351 |
| 13992 | 1392 |
| 13993 | 1422 |
| 13994 | 1466 |
| 13995 | 1492 |
| 13996 | 1494 |
| 13997 | 1488 |
| 13998 | 1495 |
| 13999 | 1497 |
| 14000 | 1487 |
| 14001 | 1476 |
| 14002 | 1471 |
| 14003 | 1455 |
| 14004 | 1446 |
| 14005 | 1419 |
| 14006 | 1456 |
| 14007 | 1452 |
| 14008 | 1383 |
| 14009 | 1320 |
| 14010 | 1250 |
| 14011 | 1172 |
| 14012 | 1088 |
| 14013 | 1026 |
| 14014 | 971 |
| 14015 | 919 |
| 14016 | 884 |
| 14017 | 852 |
| 14018 | 819 |
| 14019 | 793 |
| 14020 | 767 |
| 14021 | 750 |
| 14022 | 736 |
| 14023 | 723 |
| 14024 | 715 |
| 14025 | 705 |
| 14026 | 709 |
| 14027 | 708 |
| 14028 | 704 |
| 14029 | 710 |
| 14030 | 716 |
| 14031 | 728 |
| 14032 | 744 |
| 14033 | 756 |
| 14034 | 792 |
| 14035 | 814 |
| 14036 | 830 |
| 14037 | 831 |
| 14038 | 862 |
| 14039 | 898 |
| 14040 | 989 |
| 14041 | 1032 |
| 14042 | 1068 |
| 14043 | 1086 |
| 14044 | 1138 |
| 14045 | 1138 |
| 14046 | 1170 |
| 14047 | 1175 |
| 14048 | 1157 |
| 14049 | 1159 |
| 14050 | 1138 |
| 14051 | 1100 |
| 14052 | 1009 |
| 14053 | 958 |
| 14054 | 932 |
| 14055 | 887 |
| 14056 | 836 |
| 14057 | 807 |
| 14058 | 792 |
| 14059 | 759 |
| 14060 | 820 |
| 14061 | 810 |
| 14062 | 856 |
| 14063 | 833 |
| 14064 | 795 |
| 14065 | 905 |
| 14066 | 1048 |
| 14067 | 1034 |
| 14068 | 944 |
| 14069 | 856 |
| 14070 | 770 |
| 14071 | 754 |
| 14072 | 754 |
| 14073 | 715 |
| 14074 | 688 |
| 14075 | 797 |
| 14076 | 832 |
| 14077 | 779 |
| 14078 | 752 |
| 14079 | 857 |
| 14080 | 857 |
| 14081 | 867 |
| 14082 | 900 |
| 14083 | 881 |
| 14084 | 916 |
| 14085 | 987 |
| 14086 | 1042 |
| 14087 | 1092 |
| 14088 | 1138 |
| 14089 | 1237 |
| 14090 | 1350 |
| 14091 | 1394 |
| 14092 | 1397 |
| 14093 | 1413 |
| 14094 | 1445 |
| 14095 | 1473 |
| 14096 | 1508 |
| 14097 | 1495 |
| 14098 | 1426 |
| 14099 | 1420 |
| 14100 | 1420 |
| 14101 | 1427 |
| 14102 | 1418 |
| 14103 | 1402 |
| 14104 | 1382 |
| 14105 | 1318 |
| 14106 | 1245 |
| 14107 | 1168 |
| 14108 | 1092 |
| 14109 | 1031 |
| 14110 | 979 |
| 14111 | 947 |
| 14112 | 920 |
| 14113 | 894 |
| 14114 | 863 |
| 14115 | 840 |
| 14116 | 823 |
| 14117 | 812 |
| 14118 | 796 |
| 14119 | 783 |
| 14120 | 782 |
| 14121 | 767 |
| 14122 | 760 |
| 14123 | 759 |
| 14124 | 760 |
| 14125 | 762 |
| 14126 | 764 |
| 14127 | 768 |
| 14128 | 783 |
| 14129 | 788 |
| 14130 | 810 |
| 14131 | 821 |
| 14132 | 845 |
| 14133 | 850 |
| 14134 | 879 |
| 14135 | 916 |
| 14136 | 990 |
| 14137 | 1040 |
| 14138 | 1085 |
| 14139 | 1156 |
| 14140 | 1190 |
| 14141 | 1159 |
| 14142 | 1159 |
| 14143 | 1172 |
| 14144 | 1229 |
| 14145 | 1284 |
| 14146 | 1269 |
| 14147 | 1269 |
| 14148 | 1286 |
| 14149 | 1274 |
| 14150 | 1280 |
| 14151 | 1337 |
| 14152 | 1358 |
| 14153 | 1372 |
| 14154 | 1332 |
| 14155 | 1314 |
| 14156 | 1245 |
| 14157 | 1221 |
| 14158 | 1186 |
| 14159 | 1120 |
| 14160 | 1029 |
| 14161 | 1048 |
| 14162 | 1006 |
| 14163 | 874 |
| 14164 | 788 |
| 14165 | 712 |
| 14166 | 722 |
| 14167 | 737 |
| 14168 | 846 |
| 14169 | 872 |
| 14170 | 767 |
| 14171 | 737 |
| 14172 | 717 |
| 14173 | 607 |
| 14174 | 630 |
| 14175 | 674 |
| 14176 | 724 |
| 14177 | 739 |
| 14178 | 755 |
| 14179 | 823 |
| 14180 | 864 |
| 14181 | 924 |
| 14182 | 968 |
| 14183 | 1040 |
| 14184 | 1085 |
| 14185 | 1116 |
| 14186 | 1164 |
| 14187 | 1221 |
| 14188 | 1263 |
| 14189 | 1273 |
| 14190 | 1288 |
| 14191 | 1314 |
| 14192 | 1336 |
| 14193 | 1358 |
| 14194 | 1356 |
| 14195 | 1358 |
| 14196 | 1358 |
| 14197 | 1358 |
| 14198 | 1364 |
| 14199 | 1377 |
| 14200 | 1415 |
| 14201 | 1376 |
| 14202 | 1326 |
| 14203 | 1272 |
| 14204 | 1201 |
| 14205 | 1140 |
| 14206 | 1080 |
| 14207 | 1028 |
| 14208 | 1002 |
| 14209 | 967 |
| 14210 | 930 |
| 14211 | 902 |
| 14212 | 879 |
| 14213 | 856 |
| 14214 | 835 |
| 14215 | 817 |
| 14216 | 801 |
| 14217 | 786 |
| 14218 | 776 |
| 14219 | 771 |
| 14220 | 771 |
| 14221 | 770 |
| 14222 | 764 |
| 14223 | 763 |
| 14224 | 771 |
| 14225 | 765 |
| 14226 | 778 |
| 14227 | 773 |
| 14228 | 764 |
| 14229 | 755 |
| 14230 | 764 |
| 14231 | 771 |
| 14232 | 799 |
| 14233 | 799 |
| 14234 | 802 |
| 14235 | 810 |
| 14236 | 846 |
| 14237 | 862 |
| 14238 | 878 |
| 14239 | 893 |
| 14240 | 904 |
| 14241 | 874 |
| 14242 | 879 |
| 14243 | 909 |
| 14244 | 904 |
| 14245 | 909 |
| 14246 | 916 |
| 14247 | 944 |
| 14248 | 955 |
| 14249 | 890 |
| 14250 | 855 |
| 14251 | 826 |
| 14252 | 846 |
| 14253 | 874 |
| 14254 | 881 |
| 14255 | 877 |
| 14256 | 874 |
| 14257 | 953 |
| 14258 | 1025 |
| 14259 | 987 |
| 14260 | 929 |
| 14261 | 819 |
| 14262 | 761 |
| 14263 | 754 |
| 14264 | 656 |
| 14265 | 622 |
| 14266 | 669 |
| 14267 | 726 |
| 14268 | 772 |
| 14269 | 743 |
| 14270 | 732 |
| 14271 | 734 |
| 14272 | 700 |
| 14273 | 759 |
| 14274 | 786 |
| 14275 | 810 |
| 14276 | 825 |
| 14277 | 854 |
| 14278 | 902 |
| 14279 | 982 |
| 14280 | 1015 |
| 14281 | 1090 |
| 14282 | 1125 |
| 14283 | 1178 |
| 14284 | 1222 |
| 14285 | 1230 |
| 14286 | 1259 |
| 14287 | 1282 |
| 14288 | 1307 |
| 14289 | 1315 |
| 14290 | 1310 |
| 14291 | 1306 |
| 14292 | 1300 |
| 14293 | 1295 |
| 14294 | 1306 |
| 14295 | 1355 |
| 14296 | 1328 |
| 14297 | 1296 |
| 14298 | 1247 |
| 14299 | 1202 |
| 14300 | 1146 |
| 14301 | 1104 |
| 14302 | 1057 |
| 14303 | 1004 |
| 14304 | 970 |
| 14305 | 934 |
| 14306 | 895 |
| 14307 | 863 |
| 14308 | 840 |
| 14309 | 817 |
| 14310 | 796 |
| 14311 | 784 |
| 14312 | 768 |
| 14313 | 750 |
| 14314 | 738 |
| 14315 | 735 |
| 14316 | 730 |
| 14317 | 722 |
| 14318 | 720 |
| 14319 | 720 |
| 14320 | 722 |
| 14321 | 717 |
| 14322 | 720 |
| 14323 | 714 |
| 14324 | 687 |
| 14325 | 684 |
| 14326 | 688 |
| 14327 | 679 |
| 14328 | 693 |
| 14329 | 680 |
| 14330 | 679 |
| 14331 | 679 |
| 14332 | 692 |
| 14333 | 693 |
| 14334 | 711 |
| 14335 | 720 |
| 14336 | 720 |
| 14337 | 717 |
| 14338 | 704 |
| 14339 | 677 |
| 14340 | 642 |
| 14341 | 599 |
| 14342 | 581 |
| 14343 | 537 |
| 14344 | 531 |
| 14345 | 521 |
| 14346 | 494 |
| 14347 | 482 |
| 14348 | 516 |
| 14349 | 566 |
| 14350 | 615 |
| 14351 | 643 |
| 14352 | 628 |
| 14353 | 575 |
| 14354 | 668 |
| 14355 | 650 |
| 14356 | 586 |
| 14357 | 523 |
| 14358 | 530 |
| 14359 | 643 |
| 14360 | 586 |
| 14361 | 570 |
| 14362 | 534 |
| 14363 | 463 |
| 14364 | 432 |
| 14365 | 501 |
| 14366 | 511 |
| 14367 | 558 |
| 14368 | 617 |
| 14369 | 702 |
| 14370 | 763 |
| 14371 | 829 |
| 14372 | 925 |
| 14373 | 957 |
| 14374 | 958 |
| 14375 | 977 |
| 14376 | 1028 |
| 14377 | 1084 |
| 14378 | 1126 |
| 14379 | 1152 |
| 14380 | 1157 |
| 14381 | 1168 |
| 14382 | 1213 |
| 14383 | 1249 |
| 14384 | 1274 |
| 14385 | 1283 |
| 14386 | 1280 |
| 14387 | 1278 |
| 14388 | 1280 |
| 14389 | 1275 |
| 14390 | 1284 |
| 14391 | 1324 |
| 14392 | 1284 |
| 14393 | 1239 |
| 14394 | 1182 |
| 14395 | 1111 |
| 14396 | 1035 |
| 14397 | 971 |
| 14398 | 915 |
| 14399 | 869 |
| 14400 | 840 |
| 14401 | 814 |
| 14402 | 783 |
| 14403 | 760 |
| 14404 | 741 |
| 14405 | 729 |
| 14406 | 716 |
| 14407 | 707 |
| 14408 | 701 |
| 14409 | 695 |
| 14410 | 689 |
| 14411 | 685 |
| 14412 | 688 |
| 14413 | 687 |
| 14414 | 692 |
| 14415 | 695 |
| 14416 | 724 |
| 14417 | 734 |
| 14418 | 756 |
| 14419 | 773 |
| 14420 | 805 |
| 14421 | 818 |
| 14422 | 855 |
| 14423 | 901 |
| 14424 | 993 |
| 14425 | 1042 |
| 14426 | 1076 |
| 14427 | 1117 |
| 14428 | 1183 |
| 14429 | 1205 |
| 14430 | 1209 |
| 14431 | 1229 |
| 14432 | 1240 |
| 14433 | 1230 |
| 14434 | 1198 |
| 14435 | 1179 |
| 14436 | 1164 |
| 14437 | 1127 |
| 14438 | 1116 |
| 14439 | 1093 |
| 14440 | 1086 |
| 14441 | 1091 |
| 14442 | 1080 |
| 14443 | 1079 |
| 14444 | 1114 |
| 14445 | 1159 |
| 14446 | 1203 |
| 14447 | 1200 |
| 14448 | 1216 |
| 14449 | 1204 |
| 14450 | 1130 |
| 14451 | 1072 |
| 14452 | 1036 |
| 14453 | 1000 |
| 14454 | 967 |
| 14455 | 985 |
| 14456 | 938 |
| 14457 | 909 |
| 14458 | 826 |
| 14459 | 831 |
| 14460 | 828 |
| 14461 | 823 |
| 14462 | 795 |
| 14463 | 812 |
| 14464 | 831 |
| 14465 | 856 |
| 14466 | 903 |
| 14467 | 951 |
| 14468 | 989 |
| 14469 | 1055 |
| 14470 | 1120 |
| 14471 | 1171 |
| 14472 | 1193 |
| 14473 | 1210 |
| 14474 | 1241 |
| 14475 | 1288 |
| 14476 | 1330 |
| 14477 | 1361 |
| 14478 | 1396 |
| 14479 | 1426 |
| 14480 | 1442 |
| 14481 | 1435 |
| 14482 | 1430 |
| 14483 | 1427 |
| 14484 | 1425 |
| 14485 | 1418 |
| 14486 | 1415 |
| 14487 | 1414 |
| 14488 | 1382 |
| 14489 | 1328 |
| 14490 | 1261 |
| 14491 | 1182 |
| 14492 | 1106 |
| 14493 | 1045 |
| 14494 | 987 |
| 14495 | 935 |
| 14496 | 910 |
| 14497 | 882 |
| 14498 | 855 |
| 14499 | 830 |
| 14500 | 812 |
| 14501 | 794 |
| 14502 | 777 |
| 14503 | 774 |
| 14504 | 768 |
| 14505 | 758 |
| 14506 | 754 |
| 14507 | 753 |
| 14508 | 753 |
| 14509 | 752 |
| 14510 | 755 |
| 14511 | 763 |
| 14512 | 781 |
| 14513 | 785 |
| 14514 | 808 |
| 14515 | 832 |
| 14516 | 856 |
| 14517 | 858 |
| 14518 | 883 |
| 14519 | 926 |
| 14520 | 1010 |
| 14521 | 1065 |
| 14522 | 1092 |
| 14523 | 1120 |
| 14524 | 1182 |
| 14525 | 1216 |
| 14526 | 1229 |
| 14527 | 1242 |
| 14528 | 1243 |
| 14529 | 1237 |
| 14530 | 1225 |
| 14531 | 1209 |
| 14532 | 1162 |
| 14533 | 1147 |
| 14534 | 1156 |
| 14535 | 1129 |
| 14536 | 1090 |
| 14537 | 1070 |
| 14538 | 1060 |
| 14539 | 1070 |
| 14540 | 1065 |
| 14541 | 1077 |
| 14542 | 1081 |
| 14543 | 1089 |
| 14544 | 1097 |
| 14545 | 1053 |
| 14546 | 1008 |
| 14547 | 994 |
| 14548 | 964 |
| 14549 | 958 |
| 14550 | 955 |
| 14551 | 966 |
| 14552 | 1027 |
| 14553 | 1019 |
| 14554 | 977 |
| 14555 | 972 |
| 14556 | 975 |
| 14557 | 947 |
| 14558 | 986 |
| 14559 | 964 |
| 14560 | 947 |
| 14561 | 965 |
| 14562 | 1026 |
| 14563 | 1146 |
| 14564 | 1238 |
| 14565 | 1334 |
| 14566 | 1434 |
| 14567 | 1487 |
| 14568 | 1512 |
| 14569 | 1541 |
| 14570 | 1571 |
| 14571 | 1581 |
| 14572 | 1552 |
| 14573 | 1515 |
| 14574 | 1504 |
| 14575 | 1500 |
| 14576 | 1493 |
| 14577 | 1475 |
| 14578 | 1449 |
| 14579 | 1447 |
| 14580 | 1440 |
| 14581 | 1427 |
| 14582 | 1423 |
| 14583 | 1426 |
| 14584 | 1385 |
| 14585 | 1325 |
| 14586 | 1259 |
| 14587 | 1184 |
| 14588 | 1104 |
| 14589 | 1036 |
| 14590 | 980 |
| 14591 | 938 |
| 14592 | 929 |
| 14593 | 899 |
| 14594 | 866 |
| 14595 | 843 |
| 14596 | 824 |
| 14597 | 809 |
| 14598 | 791 |
| 14599 | 783 |
| 14600 | 776 |
| 14601 | 769 |
| 14602 | 767 |
| 14603 | 766 |
| 14604 | 764 |
| 14605 | 763 |
| 14606 | 764 |
| 14607 | 768 |
| 14608 | 787 |
| 14609 | 798 |
| 14610 | 819 |
| 14611 | 830 |
| 14612 | 848 |
| 14613 | 857 |
| 14614 | 887 |
| 14615 | 924 |
| 14616 | 1007 |
| 14617 | 1039 |
| 14618 | 1074 |
| 14619 | 1113 |
| 14620 | 1148 |
| 14621 | 1146 |
| 14622 | 1178 |
| 14623 | 1194 |
| 14624 | 1226 |
| 14625 | 1244 |
| 14626 | 1247 |
| 14627 | 1213 |
| 14628 | 1122 |
| 14629 | 1027 |
| 14630 | 992 |
| 14631 | 989 |
| 14632 | 1000 |
| 14633 | 947 |
| 14634 | 911 |
| 14635 | 925 |
| 14636 | 915 |
| 14637 | 901 |
| 14638 | 947 |
| 14639 | 987 |
| 14640 | 932 |
| 14641 | 899 |
| 14642 | 885 |
| 14643 | 846 |
| 14644 | 868 |
| 14645 | 903 |
| 14646 | 950 |
| 14647 | 931 |
| 14648 | 866 |
| 14649 | 876 |
| 14650 | 812 |
| 14651 | 792 |
| 14652 | 802 |
| 14653 | 852 |
| 14654 | 902 |
| 14655 | 901 |
| 14656 | 890 |
| 14657 | 991 |
| 14658 | 1091 |
| 14659 | 1152 |
| 14660 | 1190 |
| 14661 | 1225 |
| 14662 | 1298 |
| 14663 | 1341 |
| 14664 | 1356 |
| 14665 | 1384 |
| 14666 | 1418 |
| 14667 | 1440 |
| 14668 | 1460 |
| 14669 | 1466 |
| 14670 | 1484 |
| 14671 | 1508 |
| 14672 | 1508 |
| 14673 | 1488 |
| 14674 | 1463 |
| 14675 | 1440 |
| 14676 | 1422 |
| 14677 | 1394 |
| 14678 | 1413 |
| 14679 | 1414 |
| 14680 | 1374 |
| 14681 | 1324 |
| 14682 | 1258 |
| 14683 | 1188 |
| 14684 | 1110 |
| 14685 | 1045 |
| 14686 | 987 |
| 14687 | 940 |
| 14688 | 907 |
| 14689 | 873 |
| 14690 | 841 |
| 14691 | 813 |
| 14692 | 786 |
| 14693 | 767 |
| 14694 | 750 |
| 14695 | 737 |
| 14696 | 728 |
| 14697 | 718 |
| 14698 | 722 |
| 14699 | 720 |
| 14700 | 716 |
| 14701 | 721 |
| 14702 | 727 |
| 14703 | 733 |
| 14704 | 754 |
| 14705 | 767 |
| 14706 | 799 |
| 14707 | 808 |
| 14708 | 821 |
| 14709 | 831 |
| 14710 | 858 |
| 14711 | 894 |
| 14712 | 981 |
| 14713 | 1022 |
| 14714 | 1052 |
| 14715 | 1068 |
| 14716 | 1122 |
| 14717 | 1128 |
| 14718 | 1157 |
| 14719 | 1162 |
| 14720 | 1146 |
| 14721 | 1162 |
| 14722 | 1164 |
| 14723 | 1132 |
| 14724 | 1058 |
| 14725 | 1014 |
| 14726 | 979 |
| 14727 | 935 |
| 14728 | 897 |
| 14729 | 864 |
| 14730 | 843 |
| 14731 | 796 |
| 14732 | 855 |
| 14733 | 857 |
| 14734 | 924 |
| 14735 | 943 |
| 14736 | 925 |
| 14737 | 1022 |
| 14738 | 1122 |
| 14739 | 1047 |
| 14740 | 975 |
| 14741 | 904 |
| 14742 | 829 |
| 14743 | 804 |
| 14744 | 798 |
| 14745 | 779 |
| 14746 | 772 |
| 14747 | 867 |
| 14748 | 874 |
| 14749 | 829 |
| 14750 | 747 |
| 14751 | 833 |
| 14752 | 853 |
| 14753 | 872 |
| 14754 | 884 |
| 14755 | 876 |
| 14756 | 894 |
| 14757 | 969 |
| 14758 | 1018 |
| 14759 | 1060 |
| 14760 | 1097 |
| 14761 | 1187 |
| 14762 | 1271 |
| 14763 | 1317 |
| 14764 | 1345 |
| 14765 | 1358 |
| 14766 | 1382 |
| 14767 | 1402 |
| 14768 | 1428 |
| 14769 | 1428 |
| 14770 | 1399 |
| 14771 | 1397 |
| 14772 | 1394 |
| 14773 | 1387 |
| 14774 | 1383 |
| 14775 | 1380 |
| 14776 | 1380 |
| 14777 | 1334 |
| 14778 | 1274 |
| 14779 | 1211 |
| 14780 | 1134 |
| 14781 | 1068 |
| 14782 | 1013 |
| 14783 | 972 |
| 14784 | 942 |
| 14785 | 909 |
| 14786 | 876 |
| 14787 | 848 |
| 14788 | 827 |
| 14789 | 811 |
| 14790 | 796 |
| 14791 | 785 |
| 14792 | 782 |
| 14793 | 769 |
| 14794 | 760 |
| 14795 | 758 |
| 14796 | 759 |
| 14797 | 759 |
| 14798 | 762 |
| 14799 | 765 |
| 14800 | 781 |
| 14801 | 789 |
| 14802 | 812 |
| 14803 | 813 |
| 14804 | 833 |
| 14805 | 845 |
| 14806 | 872 |
| 14807 | 906 |
| 14808 | 985 |
| 14809 | 1028 |
| 14810 | 1058 |
| 14811 | 1106 |
| 14812 | 1146 |
| 14813 | 1144 |
| 14814 | 1141 |
| 14815 | 1137 |
| 14816 | 1148 |
| 14817 | 1164 |
| 14818 | 1127 |
| 14819 | 1104 |
| 14820 | 1076 |
| 14821 | 1040 |
| 14822 | 1035 |
| 14823 | 1076 |
| 14824 | 1070 |
| 14825 | 1086 |
| 14826 | 1053 |
| 14827 | 1037 |
| 14828 | 991 |
| 14829 | 948 |
| 14830 | 933 |
| 14831 | 907 |
| 14832 | 841 |
| 14833 | 832 |
| 14834 | 789 |
| 14835 | 711 |
| 14836 | 637 |
| 14837 | 596 |
| 14838 | 598 |
| 14839 | 614 |
| 14840 | 635 |
| 14841 | 650 |
| 14842 | 641 |
| 14843 | 613 |
| 14844 | 628 |
| 14845 | 573 |
| 14846 | 607 |
| 14847 | 656 |
| 14848 | 692 |
| 14849 | 699 |
| 14850 | 755 |
| 14851 | 822 |
| 14852 | 886 |
| 14853 | 950 |
| 14854 | 990 |
| 14855 | 1062 |
| 14856 | 1092 |
| 14857 | 1107 |
| 14858 | 1150 |
| 14859 | 1198 |
| 14860 | 1228 |
| 14861 | 1239 |
| 14862 | 1263 |
| 14863 | 1291 |
| 14864 | 1315 |
| 14865 | 1340 |
| 14866 | 1343 |
| 14867 | 1342 |
| 14868 | 1343 |
| 14869 | 1338 |
| 14870 | 1341 |
| 14871 | 1357 |
| 14872 | 1386 |
| 14873 | 1360 |
| 14874 | 1316 |
| 14875 | 1268 |
| 14876 | 1202 |
| 14877 | 1142 |
| 14878 | 1083 |
| 14879 | 1031 |
| 14880 | 1001 |
| 14881 | 964 |
| 14882 | 928 |
| 14883 | 901 |
| 14884 | 876 |
| 14885 | 856 |
| 14886 | 837 |
| 14887 | 820 |
| 14888 | 802 |
| 14889 | 788 |
| 14890 | 783 |
| 14891 | 777 |
| 14892 | 774 |
| 14893 | 772 |
| 14894 | 768 |
| 14895 | 764 |
| 14896 | 772 |
| 14897 | 766 |
| 14898 | 777 |
| 14899 | 759 |
| 14900 | 752 |
| 14901 | 752 |
| 14902 | 756 |
| 14903 | 758 |
| 14904 | 790 |
| 14905 | 796 |
| 14906 | 799 |
| 14907 | 818 |
| 14908 | 848 |
| 14909 | 852 |
| 14910 | 861 |
| 14911 | 874 |
| 14912 | 902 |
| 14913 | 906 |
| 14914 | 892 |
| 14915 | 894 |
| 14916 | 899 |
| 14917 | 850 |
| 14918 | 817 |
| 14919 | 818 |
| 14920 | 844 |
| 14921 | 787 |
| 14922 | 785 |
| 14923 | 792 |
| 14924 | 807 |
| 14925 | 852 |
| 14926 | 932 |
| 14927 | 940 |
| 14928 | 938 |
| 14929 | 1007 |
| 14930 | 1005 |
| 14931 | 948 |
| 14932 | 943 |
| 14933 | 888 |
| 14934 | 810 |
| 14935 | 828 |
| 14936 | 824 |
| 14937 | 813 |
| 14938 | 790 |
| 14939 | 746 |
| 14940 | 787 |
| 14941 | 872 |
| 14942 | 928 |
| 14943 | 941 |
| 14944 | 892 |
| 14945 | 900 |
| 14946 | 892 |
| 14947 | 874 |
| 14948 | 857 |
| 14949 | 860 |
| 14950 | 867 |
| 14951 | 956 |
| 14952 | 996 |
| 14953 | 1080 |
| 14954 | 1139 |
| 14955 | 1170 |
| 14956 | 1210 |
| 14957 | 1219 |
| 14958 | 1252 |
| 14959 | 1282 |
| 14960 | 1306 |
| 14961 | 1311 |
| 14962 | 1299 |
| 14963 | 1288 |
| 14964 | 1283 |
| 14965 | 1280 |
| 14966 | 1281 |
| 14967 | 1310 |
| 14968 | 1302 |
| 14969 | 1282 |
| 14970 | 1235 |
| 14971 | 1190 |
| 14972 | 1136 |
| 14973 | 1095 |
| 14974 | 1052 |
| 14975 | 1004 |
| 14976 | 967 |
| 14977 | 934 |
| 14978 | 895 |
| 14979 | 870 |
| 14980 | 846 |
| 14981 | 824 |
| 14982 | 804 |
| 14983 | 790 |
| 14984 | 772 |
| 14985 | 752 |
| 14986 | 739 |
| 14987 | 733 |
| 14988 | 728 |
| 14989 | 719 |
| 14990 | 716 |
| 14991 | 713 |
| 14992 | 716 |
| 14993 | 709 |
| 14994 | 712 |
| 14995 | 698 |
| 14996 | 680 |
| 14997 | 676 |
| 14998 | 675 |
| 14999 | 668 |
| 15000 | 678 |
| 15001 | 666 |
| 15002 | 664 |
| 15003 | 663 |
| 15004 | 676 |
| 15005 | 678 |
| 15006 | 697 |
| 15007 | 702 |
| 15008 | 703 |
| 15009 | 700 |
| 15010 | 681 |
| 15011 | 655 |
| 15012 | 622 |
| 15013 | 572 |
| 15014 | 557 |
| 15015 | 503 |
| 15016 | 509 |
| 15017 | 507 |
| 15018 | 468 |
| 15019 | 478 |
| 15020 | 518 |
| 15021 | 590 |
| 15022 | 640 |
| 15023 | 651 |
| 15024 | 620 |
| 15025 | 576 |
| 15026 | 654 |
| 15027 | 685 |
| 15028 | 670 |
| 15029 | 642 |
| 15030 | 616 |
| 15031 | 723 |
| 15032 | 644 |
| 15033 | 590 |
| 15034 | 565 |
| 15035 | 566 |
| 15036 | 455 |
| 15037 | 482 |
| 15038 | 515 |
| 15039 | 567 |
| 15040 | 654 |
| 15041 | 730 |
| 15042 | 760 |
| 15043 | 818 |
| 15044 | 897 |
| 15045 | 931 |
| 15046 | 944 |
| 15047 | 974 |
| 15048 | 1052 |
| 15049 | 1106 |
| 15050 | 1110 |
| 15051 | 1130 |
| 15052 | 1148 |
| 15053 | 1174 |
| 15054 | 1213 |
| 15055 | 1239 |
| 15056 | 1264 |
| 15057 | 1276 |
| 15058 | 1276 |
| 15059 | 1275 |
| 15060 | 1282 |
| 15061 | 1279 |
| 15062 | 1282 |
| 15063 | 1309 |
| 15064 | 1293 |
| 15065 | 1264 |
| 15066 | 1208 |
| 15067 | 1140 |
| 15068 | 1060 |
| 15069 | 998 |
| 15070 | 942 |
| 15071 | 894 |
| 15072 | 867 |
| 15073 | 838 |
| 15074 | 802 |
| 15075 | 776 |
| 15076 | 754 |
| 15077 | 744 |
| 15078 | 732 |
| 15079 | 725 |
| 15080 | 716 |
| 15081 | 709 |
| 15082 | 700 |
| 15083 | 699 |
| 15084 | 706 |
| 15085 | 705 |
| 15086 | 710 |
| 15087 | 711 |
| 15088 | 737 |
| 15089 | 748 |
| 15090 | 772 |
| 15091 | 770 |
| 15092 | 792 |
| 15093 | 815 |
| 15094 | 849 |
| 15095 | 892 |
| 15096 | 970 |
| 15097 | 1006 |
| 15098 | 1033 |
| 15099 | 1062 |
| 15100 | 1112 |
| 15101 | 1114 |
| 15102 | 1106 |
| 15103 | 1114 |
| 15104 | 1118 |
| 15105 | 1104 |
| 15106 | 1078 |
| 15107 | 1042 |
| 15108 | 997 |
| 15109 | 955 |
| 15110 | 903 |
| 15111 | 867 |
| 15112 | 840 |
| 15113 | 819 |
| 15114 | 800 |
| 15115 | 817 |
| 15116 | 887 |
| 15117 | 984 |
| 15118 | 1054 |
| 15119 | 1057 |
| 15120 | 1060 |
| 15121 | 1068 |
| 15122 | 1016 |
| 15123 | 972 |
| 15124 | 940 |
| 15125 | 905 |
| 15126 | 891 |
| 15127 | 867 |
| 15128 | 760 |
| 15129 | 754 |
| 15130 | 720 |
| 15131 | 748 |
| 15132 | 734 |
| 15133 | 760 |
| 15134 | 711 |
| 15135 | 708 |
| 15136 | 754 |
| 15137 | 791 |
| 15138 | 815 |
| 15139 | 879 |
| 15140 | 915 |
| 15141 | 991 |
| 15142 | 1061 |
| 15143 | 1107 |
| 15144 | 1130 |
| 15145 | 1167 |
| 15146 | 1216 |
| 15147 | 1275 |
| 15148 | 1274 |
| 15149 | 1254 |
| 15150 | 1274 |
| 15151 | 1303 |
| 15152 | 1326 |
| 15153 | 1328 |
| 15154 | 1335 |
| 15155 | 1346 |
| 15156 | 1353 |
| 15157 | 1341 |
| 15158 | 1345 |
| 15159 | 1360 |
| 15160 | 1353 |
| 15161 | 1306 |
| 15162 | 1248 |
| 15163 | 1170 |
| 15164 | 1096 |
| 15165 | 1031 |
| 15166 | 974 |
| 15167 | 925 |
| 15168 | 901 |
| 15169 | 874 |
| 15170 | 849 |
| 15171 | 826 |
| 15172 | 806 |
| 15173 | 789 |
| 15174 | 775 |
| 15175 | 770 |
| 15176 | 763 |
| 15177 | 754 |
| 15178 | 750 |
| 15179 | 746 |
| 15180 | 748 |
| 15181 | 744 |
| 15182 | 744 |
| 15183 | 753 |
| 15184 | 772 |
| 15185 | 775 |
| 15186 | 800 |
| 15187 | 820 |
| 15188 | 834 |
| 15189 | 837 |
| 15190 | 866 |
| 15191 | 906 |
| 15192 | 992 |
| 15193 | 1043 |
| 15194 | 1074 |
| 15195 | 1094 |
| 15196 | 1152 |
| 15197 | 1180 |
| 15198 | 1194 |
| 15199 | 1207 |
| 15200 | 1200 |
| 15201 | 1188 |
| 15202 | 1173 |
| 15203 | 1153 |
| 15204 | 1106 |
| 15205 | 1076 |
| 15206 | 1070 |
| 15207 | 1038 |
| 15208 | 1000 |
| 15209 | 966 |
| 15210 | 941 |
| 15211 | 936 |
| 15212 | 927 |
| 15213 | 948 |
| 15214 | 978 |
| 15215 | 982 |
| 15216 | 977 |
| 15217 | 919 |
| 15218 | 874 |
| 15219 | 851 |
| 15220 | 836 |
| 15221 | 820 |
| 15222 | 826 |
| 15223 | 852 |
| 15224 | 928 |
| 15225 | 918 |
| 15226 | 897 |
| 15227 | 935 |
| 15228 | 914 |
| 15229 | 874 |
| 15230 | 932 |
| 15231 | 867 |
| 15232 | 858 |
| 15233 | 894 |
| 15234 | 1014 |
| 15235 | 1135 |
| 15236 | 1205 |
| 15237 | 1239 |
| 15238 | 1296 |
| 15239 | 1319 |
| 15240 | 1331 |
| 15241 | 1363 |
| 15242 | 1413 |
| 15243 | 1436 |
| 15244 | 1433 |
| 15245 | 1414 |
| 15246 | 1418 |
| 15247 | 1426 |
| 15248 | 1429 |
| 15249 | 1426 |
| 15250 | 1412 |
| 15251 | 1418 |
| 15252 | 1410 |
| 15253 | 1384 |
| 15254 | 1376 |
| 15255 | 1379 |
| 15256 | 1364 |
| 15257 | 1325 |
| 15258 | 1264 |
| 15259 | 1199 |
| 15260 | 1122 |
| 15261 | 1049 |
| 15262 | 989 |
| 15263 | 942 |
| 15264 | 923 |
| 15265 | 887 |
| 15266 | 854 |
| 15267 | 830 |
| 15268 | 813 |
| 15269 | 799 |
| 15270 | 782 |
| 15271 | 773 |
| 15272 | 766 |
| 15273 | 761 |
| 15274 | 758 |
| 15275 | 755 |
| 15276 | 755 |
| 15277 | 753 |
| 15278 | 754 |
| 15279 | 760 |
| 15280 | 782 |
| 15281 | 792 |
| 15282 | 809 |
| 15283 | 811 |
| 15284 | 826 |
| 15285 | 844 |
| 15286 | 874 |
| 15287 | 914 |
| 15288 | 994 |
| 15289 | 1030 |
| 15290 | 1061 |
| 15291 | 1091 |
| 15292 | 1131 |
| 15293 | 1123 |
| 15294 | 1159 |
| 15295 | 1180 |
| 15296 | 1211 |
| 15297 | 1224 |
| 15298 | 1216 |
| 15299 | 1185 |
| 15300 | 1087 |
| 15301 | 987 |
| 15302 | 955 |
| 15303 | 947 |
| 15304 | 976 |
| 15305 | 942 |
| 15306 | 932 |
| 15307 | 916 |
| 15308 | 913 |
| 15309 | 913 |
| 15310 | 946 |
| 15311 | 947 |
| 15312 | 944 |
| 15313 | 900 |
| 15314 | 891 |
| 15315 | 859 |
| 15316 | 863 |
| 15317 | 881 |
| 15318 | 888 |
| 15319 | 868 |
| 15320 | 812 |
| 15321 | 792 |
| 15322 | 746 |
| 15323 | 733 |
| 15324 | 757 |
| 15325 | 756 |
| 15326 | 789 |
| 15327 | 820 |
| 15328 | 826 |
| 15329 | 899 |
| 15330 | 1011 |
| 15331 | 1058 |
| 15332 | 1087 |
| 15333 | 1119 |
| 15334 | 1194 |
| 15335 | 1232 |
| 15336 | 1243 |
| 15337 | 1280 |
| 15338 | 1315 |
| 15339 | 1349 |
| 15340 | 1375 |
| 15341 | 1375 |
| 15342 | 1390 |
| 15343 | 1416 |
| 15344 | 1425 |
| 15345 | 1411 |
| 15346 | 1392 |
| 15347 | 1378 |
| 15348 | 1363 |
| 15349 | 1341 |
| 15350 | 1345 |
| 15351 | 1358 |
| 15352 | 1341 |
| 15353 | 1304 |
| 15354 | 1252 |
| 15355 | 1190 |
| 15356 | 1127 |
| 15357 | 1064 |
| 15358 | 1001 |
| 15359 | 954 |
| 15360 | 922 |
| 15361 | 884 |
| 15362 | 850 |
| 15363 | 828 |
| 15364 | 802 |
| 15365 | 785 |
| 15366 | 764 |
| 15367 | 749 |
| 15368 | 738 |
| 15369 | 730 |
| 15370 | 729 |
| 15371 | 729 |
| 15372 | 726 |
| 15373 | 728 |
| 15374 | 731 |
| 15375 | 733 |
| 15376 | 751 |
| 15377 | 757 |
| 15378 | 778 |
| 15379 | 770 |
| 15380 | 780 |
| 15381 | 787 |
| 15382 | 806 |
| 15383 | 826 |
| 15384 | 883 |
| 15385 | 905 |
| 15386 | 919 |
| 15387 | 925 |
| 15388 | 963 |
| 15389 | 966 |
| 15390 | 986 |
| 15391 | 996 |
| 15392 | 990 |
| 15393 | 1004 |
| 15394 | 1010 |
| 15395 | 988 |
| 15396 | 942 |
| 15397 | 917 |
| 15398 | 938 |
| 15399 | 899 |
| 15400 | 842 |
| 15401 | 822 |
| 15402 | 813 |
| 15403 | 787 |
| 15404 | 852 |
| 15405 | 870 |
| 15406 | 932 |
| 15407 | 947 |
| 15408 | 922 |
| 15409 | 942 |
| 15410 | 979 |
| 15411 | 886 |
| 15412 | 806 |
| 15413 | 719 |
| 15414 | 664 |
| 15415 | 631 |
| 15416 | 629 |
| 15417 | 622 |
| 15418 | 599 |
| 15419 | 672 |
| 15420 | 666 |
| 15421 | 656 |
| 15422 | 580 |
| 15423 | 665 |
| 15424 | 706 |
| 15425 | 742 |
| 15426 | 768 |
| 15427 | 743 |
| 15428 | 746 |
| 15429 | 816 |
| 15430 | 913 |
| 15431 | 995 |
| 15432 | 1031 |
| 15433 | 1084 |
| 15434 | 1189 |
| 15435 | 1245 |
| 15436 | 1272 |
| 15437 | 1270 |
| 15438 | 1287 |
| 15439 | 1309 |
| 15440 | 1328 |
| 15441 | 1341 |
| 15442 | 1340 |
| 15443 | 1344 |
| 15444 | 1336 |
| 15445 | 1326 |
| 15446 | 1330 |
| 15447 | 1349 |
| 15448 | 1344 |
| 15449 | 1304 |
| 15450 | 1250 |
| 15451 | 1198 |
| 15452 | 1129 |
| 15453 | 1061 |
| 15454 | 1004 |
| 15455 | 957 |
| 15456 | 929 |
| 15457 | 892 |
| 15458 | 858 |
| 15459 | 829 |
| 15460 | 807 |
| 15461 | 790 |
| 15462 | 776 |
| 15463 | 766 |
| 15464 | 761 |
| 15465 | 752 |
| 15466 | 742 |
| 15467 | 738 |
| 15468 | 738 |
| 15469 | 738 |
| 15470 | 740 |
| 15471 | 743 |
| 15472 | 763 |
| 15473 | 771 |
| 15474 | 790 |
| 15475 | 790 |
| 15476 | 798 |
| 15477 | 810 |
| 15478 | 832 |
| 15479 | 865 |
| 15480 | 941 |
| 15481 | 974 |
| 15482 | 1002 |
| 15483 | 1046 |
| 15484 | 1098 |
| 15485 | 1121 |
| 15486 | 1134 |
| 15487 | 1135 |
| 15488 | 1139 |
| 15489 | 1141 |
| 15490 | 1096 |
| 15491 | 1036 |
| 15492 | 1023 |
| 15493 | 1007 |
| 15494 | 993 |
| 15495 | 1065 |
| 15496 | 1043 |
| 15497 | 1049 |
| 15498 | 1029 |
| 15499 | 1010 |
| 15500 | 978 |
| 15501 | 959 |
| 15502 | 957 |
| 15503 | 919 |
| 15504 | 873 |
| 15505 | 845 |
| 15506 | 847 |
| 15507 | 827 |
| 15508 | 762 |
| 15509 | 736 |
| 15510 | 735 |
| 15511 | 749 |
| 15512 | 713 |
| 15513 | 673 |
| 15514 | 687 |
| 15515 | 663 |
| 15516 | 693 |
| 15517 | 682 |
| 15518 | 668 |
| 15519 | 728 |
| 15520 | 793 |
| 15521 | 800 |
| 15522 | 818 |
| 15523 | 886 |
| 15524 | 991 |
| 15525 | 1045 |
| 15526 | 1085 |
| 15527 | 1143 |
| 15528 | 1141 |
| 15529 | 1132 |
| 15530 | 1185 |
| 15531 | 1237 |
| 15532 | 1257 |
| 15533 | 1251 |
| 15534 | 1268 |
| 15535 | 1287 |
| 15536 | 1313 |
| 15537 | 1336 |
| 15538 | 1342 |
| 15539 | 1340 |
| 15540 | 1337 |
| 15541 | 1325 |
| 15542 | 1321 |
| 15543 | 1332 |
| 15544 | 1356 |
| 15545 | 1335 |
| 15546 | 1290 |
| 15547 | 1245 |
| 15548 | 1181 |
| 15549 | 1123 |
| 15550 | 1064 |
| 15551 | 1015 |
| 15552 | 983 |
| 15553 | 948 |
| 15554 | 911 |
| 15555 | 885 |
| 15556 | 856 |
| 15557 | 839 |
| 15558 | 822 |
| 15559 | 807 |
| 15560 | 789 |
| 15561 | 775 |
| 15562 | 770 |
| 15563 | 765 |
| 15564 | 764 |
| 15565 | 759 |
| 15566 | 758 |
| 15567 | 754 |
| 15568 | 761 |
| 15569 | 757 |
| 15570 | 764 |
| 15571 | 744 |
| 15572 | 737 |
| 15573 | 740 |
| 15574 | 742 |
| 15575 | 746 |
| 15576 | 786 |
| 15577 | 789 |
| 15578 | 787 |
| 15579 | 806 |
| 15580 | 840 |
| 15581 | 841 |
| 15582 | 855 |
| 15583 | 864 |
| 15584 | 893 |
| 15585 | 919 |
| 15586 | 910 |
| 15587 | 925 |
| 15588 | 939 |
| 15589 | 903 |
| 15590 | 885 |
| 15591 | 894 |
| 15592 | 916 |
| 15593 | 918 |
| 15594 | 906 |
| 15595 | 905 |
| 15596 | 931 |
| 15597 | 958 |
| 15598 | 1021 |
| 15599 | 1005 |
| 15600 | 1002 |
| 15601 | 1026 |
| 15602 | 984 |
| 15603 | 993 |
| 15604 | 1010 |
| 15605 | 964 |
| 15606 | 902 |
| 15607 | 916 |
| 15608 | 924 |
| 15609 | 914 |
| 15610 | 884 |
| 15611 | 824 |
| 15612 | 842 |
| 15613 | 924 |
| 15614 | 963 |
| 15615 | 966 |
| 15616 | 933 |
| 15617 | 916 |
| 15618 | 890 |
| 15619 | 872 |
| 15620 | 884 |
| 15621 | 889 |
| 15622 | 882 |
| 15623 | 943 |
| 15624 | 975 |
| 15625 | 1058 |
| 15626 | 1122 |
| 15627 | 1140 |
| 15628 | 1180 |
| 15629 | 1197 |
| 15630 | 1235 |
| 15631 | 1263 |
| 15632 | 1281 |
| 15633 | 1284 |
| 15634 | 1277 |
| 15635 | 1269 |
| 15636 | 1252 |
| 15637 | 1238 |
| 15638 | 1229 |
| 15639 | 1255 |
| 15640 | 1259 |
| 15641 | 1243 |
| 15642 | 1203 |
| 15643 | 1168 |
| 15644 | 1137 |
| 15645 | 1102 |
| 15646 | 1059 |
| 15647 | 1008 |
| 15648 | 971 |
| 15649 | 938 |
| 15650 | 901 |
| 15651 | 878 |
| 15652 | 853 |
| 15653 | 828 |
| 15654 | 808 |
| 15655 | 792 |
| 15656 | 774 |
| 15657 | 755 |
| 15658 | 740 |
| 15659 | 733 |
| 15660 | 730 |
| 15661 | 719 |
| 15662 | 717 |
| 15663 | 712 |
| 15664 | 713 |
| 15665 | 706 |
| 15666 | 708 |
| 15667 | 686 |
| 15668 | 676 |
| 15669 | 670 |
| 15670 | 668 |
| 15671 | 660 |
| 15672 | 662 |
| 15673 | 647 |
| 15674 | 642 |
| 15675 | 634 |
| 15676 | 637 |
| 15677 | 633 |
| 15678 | 628 |
| 15679 | 625 |
| 15680 | 621 |
| 15681 | 615 |
| 15682 | 604 |
| 15683 | 598 |
| 15684 | 592 |
| 15685 | 575 |
| 15686 | 600 |
| 15687 | 561 |
| 15688 | 556 |
| 15689 | 524 |
| 15690 | 482 |
| 15691 | 501 |
| 15692 | 524 |
| 15693 | 632 |
| 15694 | 686 |
| 15695 | 651 |
| 15696 | 625 |
| 15697 | 585 |
| 15698 | 588 |
| 15699 | 600 |
| 15700 | 599 |
| 15701 | 619 |
| 15702 | 539 |
| 15703 | 650 |
| 15704 | 591 |
| 15705 | 503 |
| 15706 | 501 |
| 15707 | 490 |
| 15708 | 409 |
| 15709 | 432 |
| 15710 | 421 |
| 15711 | 439 |
| 15712 | 529 |
| 15713 | 575 |
| 15714 | 587 |
| 15715 | 650 |
| 15716 | 742 |
| 15717 | 793 |
| 15718 | 830 |
| 15719 | 857 |
| 15720 | 942 |
| 15721 | 1017 |
| 15722 | 1042 |
| 15723 | 1076 |
| 15724 | 1122 |
| 15725 | 1158 |
| 15726 | 1192 |
| 15727 | 1216 |
| 15728 | 1243 |
| 15729 | 1250 |
| 15730 | 1252 |
| 15731 | 1246 |
| 15732 | 1248 |
| 15733 | 1243 |
| 15734 | 1237 |
| 15735 | 1253 |
| 15736 | 1260 |
| 15737 | 1244 |
| 15738 | 1193 |
| 15739 | 1130 |
| 15740 | 1053 |
| 15741 | 996 |
| 15742 | 939 |
| 15743 | 898 |
| 15744 | 868 |
| 15745 | 836 |
| 15746 | 802 |
| 15747 | 778 |
| 15748 | 759 |
| 15749 | 749 |
| 15750 | 736 |
| 15751 | 729 |
| 15752 | 714 |
| 15753 | 704 |
| 15754 | 695 |
| 15755 | 692 |
| 15756 | 697 |
| 15757 | 697 |
| 15758 | 702 |
| 15759 | 704 |
| 15760 | 729 |
| 15761 | 743 |
| 15762 | 763 |
| 15763 | 754 |
| 15764 | 783 |
| 15765 | 804 |
| 15766 | 835 |
| 15767 | 878 |
| 15768 | 957 |
| 15769 | 996 |
| 15770 | 1028 |
| 15771 | 1052 |
| 15772 | 1096 |
| 15773 | 1105 |
| 15774 | 1100 |
| 15775 | 1101 |
| 15776 | 1099 |
| 15777 | 1086 |
| 15778 | 1071 |
| 15779 | 1035 |
| 15780 | 988 |
| 15781 | 946 |
| 15782 | 900 |
| 15783 | 873 |
| 15784 | 839 |
| 15785 | 819 |
| 15786 | 799 |
| 15787 | 818 |
| 15788 | 876 |
| 15789 | 964 |
| 15790 | 1031 |
| 15791 | 1027 |
| 15792 | 1016 |
| 15793 | 1002 |
| 15794 | 942 |
| 15795 | 897 |
| 15796 | 866 |
| 15797 | 851 |
| 15798 | 836 |
| 15799 | 770 |
| 15800 | 682 |
| 15801 | 692 |
| 15802 | 694 |
| 15803 | 697 |
| 15804 | 683 |
| 15805 | 706 |
| 15806 | 674 |
| 15807 | 677 |
| 15808 | 717 |
| 15809 | 777 |
| 15810 | 795 |
| 15811 | 876 |
| 15812 | 926 |
| 15813 | 1003 |
| 15814 | 1070 |
| 15815 | 1115 |
| 15816 | 1158 |
| 15817 | 1205 |
| 15818 | 1227 |
| 15819 | 1312 |
| 15820 | 1307 |
| 15821 | 1283 |
| 15822 | 1296 |
| 15823 | 1326 |
| 15824 | 1343 |
| 15825 | 1344 |
| 15826 | 1343 |
| 15827 | 1339 |
| 15828 | 1344 |
| 15829 | 1333 |
| 15830 | 1329 |
| 15831 | 1331 |
| 15832 | 1337 |
| 15833 | 1297 |
| 15834 | 1242 |
| 15835 | 1170 |
| 15836 | 1091 |
| 15837 | 1030 |
| 15838 | 978 |
| 15839 | 931 |
| 15840 | 901 |
| 15841 | 868 |
| 15842 | 841 |
| 15843 | 821 |
| 15844 | 801 |
| 15845 | 786 |
| 15846 | 774 |
| 15847 | 766 |
| 15848 | 756 |
| 15849 | 745 |
| 15850 | 741 |
| 15851 | 737 |
| 15852 | 738 |
| 15853 | 734 |
| 15854 | 736 |
| 15855 | 744 |
| 15856 | 762 |
| 15857 | 766 |
| 15858 | 788 |
| 15859 | 802 |
| 15860 | 818 |
| 15861 | 825 |
| 15862 | 856 |
| 15863 | 900 |
| 15864 | 991 |
| 15865 | 1037 |
| 15866 | 1070 |
| 15867 | 1094 |
| 15868 | 1153 |
| 15869 | 1172 |
| 15870 | 1182 |
| 15871 | 1193 |
| 15872 | 1192 |
| 15873 | 1178 |
| 15874 | 1163 |
| 15875 | 1139 |
| 15876 | 1097 |
| 15877 | 1064 |
| 15878 | 1045 |
| 15879 | 1030 |
| 15880 | 1020 |
| 15881 | 988 |
| 15882 | 960 |
| 15883 | 954 |
| 15884 | 934 |
| 15885 | 940 |
| 15886 | 954 |
| 15887 | 954 |
| 15888 | 932 |
| 15889 | 886 |
| 15890 | 863 |
| 15891 | 867 |
| 15892 | 869 |
| 15893 | 861 |
| 15894 | 835 |
| 15895 | 834 |
| 15896 | 867 |
| 15897 | 891 |
| 15898 | 883 |
| 15899 | 919 |
| 15900 | 882 |
| 15901 | 872 |
| 15902 | 930 |
| 15903 | 900 |
| 15904 | 908 |
| 15905 | 938 |
| 15906 | 1076 |
| 15907 | 1106 |
| 15908 | 1090 |
| 15909 | 1086 |
| 15910 | 1105 |
| 15911 | 1132 |
| 15912 | 1180 |
| 15913 | 1223 |
| 15914 | 1286 |
| 15915 | 1340 |
| 15916 | 1362 |
| 15917 | 1367 |
| 15918 | 1388 |
| 15919 | 1408 |
| 15920 | 1430 |
| 15921 | 1445 |
| 15922 | 1438 |
| 15923 | 1437 |
| 15924 | 1419 |
| 15925 | 1392 |
| 15926 | 1378 |
| 15927 | 1360 |
| 15928 | 1350 |
| 15929 | 1319 |
| 15930 | 1259 |
| 15931 | 1198 |
| 15932 | 1120 |
| 15933 | 1043 |
| 15934 | 984 |
| 15935 | 938 |
| 15936 | 920 |
| 15937 | 882 |
| 15938 | 847 |
| 15939 | 821 |
| 15940 | 805 |
| 15941 | 792 |
| 15942 | 777 |
| 15943 | 770 |
| 15944 | 762 |
| 15945 | 756 |
| 15946 | 751 |
| 15947 | 750 |
| 15948 | 751 |
| 15949 | 749 |
| 15950 | 752 |
| 15951 | 757 |
| 15952 | 780 |
| 15953 | 788 |
| 15954 | 803 |
| 15955 | 807 |
| 15956 | 818 |
| 15957 | 836 |
| 15958 | 869 |
| 15959 | 916 |
| 15960 | 999 |
| 15961 | 1040 |
| 15962 | 1080 |
| 15963 | 1123 |
| 15964 | 1168 |
| 15965 | 1159 |
| 15966 | 1195 |
| 15967 | 1226 |
| 15968 | 1269 |
| 15969 | 1283 |
| 15970 | 1295 |
| 15971 | 1263 |
| 15972 | 1145 |
| 15973 | 1040 |
| 15974 | 1012 |
| 15975 | 1001 |
| 15976 | 1022 |
| 15977 | 1027 |
| 15978 | 1024 |
| 15979 | 1020 |
| 15980 | 988 |
| 15981 | 955 |
| 15982 | 974 |
| 15983 | 977 |
| 15984 | 950 |
| 15985 | 891 |
| 15986 | 841 |
| 15987 | 770 |
| 15988 | 752 |
| 15989 | 707 |
| 15990 | 703 |
| 15991 | 724 |
| 15992 | 706 |
| 15993 | 660 |
| 15994 | 651 |
| 15995 | 680 |
| 15996 | 710 |
| 15997 | 659 |
| 15998 | 670 |
| 15999 | 724 |
| 16000 | 760 |
| 16001 | 749 |
| 16002 | 772 |
| 16003 | 829 |
| 16004 | 859 |
| 16005 | 872 |
| 16006 | 944 |
| 16007 | 1023 |
| 16008 | 1074 |
| 16009 | 1137 |
| 16010 | 1168 |
| 16011 | 1202 |
| 16012 | 1239 |
| 16013 | 1258 |
| 16014 | 1281 |
| 16015 | 1323 |
| 16016 | 1346 |
| 16017 | 1346 |
| 16018 | 1332 |
| 16019 | 1336 |
| 16020 | 1328 |
| 16021 | 1314 |
| 16022 | 1304 |
| 16023 | 1323 |
| 16024 | 1330 |
| 16025 | 1311 |
| 16026 | 1260 |
| 16027 | 1202 |
| 16028 | 1139 |
| 16029 | 1076 |
| 16030 | 1017 |
| 16031 | 971 |
| 16032 | 938 |
| 16033 | 900 |
| 16034 | 865 |
| 16035 | 844 |
| 16036 | 823 |
| 16037 | 807 |
| 16038 | 786 |
| 16039 | 770 |
| 16040 | 761 |
| 16041 | 751 |
| 16042 | 746 |
| 16043 | 745 |
| 16044 | 748 |
| 16045 | 746 |
| 16046 | 748 |
| 16047 | 746 |
| 16048 | 762 |
| 16049 | 764 |
| 16050 | 776 |
| 16051 | 760 |
| 16052 | 776 |
| 16053 | 784 |
| 16054 | 808 |
| 16055 | 831 |
| 16056 | 885 |
| 16057 | 901 |
| 16058 | 916 |
| 16059 | 921 |
| 16060 | 961 |
| 16061 | 966 |
| 16062 | 961 |
| 16063 | 980 |
| 16064 | 995 |
| 16065 | 1000 |
| 16066 | 982 |
| 16067 | 969 |
| 16068 | 958 |
| 16069 | 943 |
| 16070 | 952 |
| 16071 | 934 |
| 16072 | 901 |
| 16073 | 885 |
| 16074 | 906 |
| 16075 | 910 |
| 16076 | 930 |
| 16077 | 956 |
| 16078 | 986 |
| 16079 | 1011 |
| 16080 | 998 |
| 16081 | 933 |
| 16082 | 860 |
| 16083 | 775 |
| 16084 | 721 |
| 16085 | 700 |
| 16086 | 708 |
| 16087 | 646 |
| 16088 | 631 |
| 16089 | 589 |
| 16090 | 564 |
| 16091 | 545 |
| 16092 | 537 |
| 16093 | 585 |
| 16094 | 557 |
| 16095 | 586 |
| 16096 | 626 |
| 16097 | 679 |
| 16098 | 727 |
| 16099 | 719 |
| 16100 | 749 |
| 16101 | 814 |
| 16102 | 921 |
| 16103 | 1015 |
| 16104 | 1064 |
| 16105 | 1058 |
| 16106 | 1139 |
| 16107 | 1209 |
| 16108 | 1221 |
| 16109 | 1212 |
| 16110 | 1221 |
| 16111 | 1247 |
| 16112 | 1284 |
| 16113 | 1296 |
| 16114 | 1300 |
| 16115 | 1312 |
| 16116 | 1307 |
| 16117 | 1297 |
| 16118 | 1296 |
| 16119 | 1321 |
| 16120 | 1311 |
| 16121 | 1286 |
| 16122 | 1239 |
| 16123 | 1193 |
| 16124 | 1120 |
| 16125 | 1052 |
| 16126 | 998 |
| 16127 | 955 |
| 16128 | 925 |
| 16129 | 886 |
| 16130 | 850 |
| 16131 | 821 |
| 16132 | 797 |
| 16133 | 779 |
| 16134 | 768 |
| 16135 | 758 |
| 16136 | 751 |
| 16137 | 746 |
| 16138 | 737 |
| 16139 | 733 |
| 16140 | 733 |
| 16141 | 730 |
| 16142 | 733 |
| 16143 | 734 |
| 16144 | 756 |
| 16145 | 763 |
| 16146 | 777 |
| 16147 | 777 |
| 16148 | 787 |
| 16149 | 798 |
| 16150 | 821 |
| 16151 | 860 |
| 16152 | 936 |
| 16153 | 969 |
| 16154 | 1000 |
| 16155 | 1039 |
| 16156 | 1081 |
| 16157 | 1108 |
| 16158 | 1116 |
| 16159 | 1116 |
| 16160 | 1131 |
| 16161 | 1122 |
| 16162 | 1085 |
| 16163 | 1012 |
| 16164 | 1001 |
| 16165 | 985 |
| 16166 | 961 |
| 16167 | 1012 |
| 16168 | 993 |
| 16169 | 964 |
| 16170 | 956 |
| 16171 | 930 |
| 16172 | 920 |
| 16173 | 914 |
| 16174 | 938 |
| 16175 | 908 |
| 16176 | 879 |
| 16177 | 834 |
| 16178 | 845 |
| 16179 | 816 |
| 16180 | 771 |
| 16181 | 801 |
| 16182 | 828 |
| 16183 | 861 |
| 16184 | 828 |
| 16185 | 806 |
| 16186 | 838 |
| 16187 | 783 |
| 16188 | 734 |
| 16189 | 670 |
| 16190 | 664 |
| 16191 | 745 |
| 16192 | 841 |
| 16193 | 858 |
| 16194 | 845 |
| 16195 | 885 |
| 16196 | 1002 |
| 16197 | 1066 |
| 16198 | 1104 |
| 16199 | 1177 |
| 16200 | 1177 |
| 16201 | 1191 |
| 16202 | 1260 |
| 16203 | 1317 |
| 16204 | 1335 |
| 16205 | 1333 |
| 16206 | 1349 |
| 16207 | 1369 |
| 16208 | 1386 |
| 16209 | 1392 |
| 16210 | 1377 |
| 16211 | 1362 |
| 16212 | 1351 |
| 16213 | 1331 |
| 16214 | 1316 |
| 16215 | 1314 |
| 16216 | 1334 |
| 16217 | 1316 |
| 16218 | 1267 |
| 16219 | 1217 |
| 16220 | 1157 |
| 16221 | 1102 |
| 16222 | 1049 |
| 16223 | 1004 |
| 16224 | 967 |
| 16225 | 933 |
| 16226 | 890 |
| 16227 | 866 |
| 16228 | 847 |
| 16229 | 832 |
| 16230 | 813 |
| 16231 | 800 |
| 16232 | 787 |
| 16233 | 773 |
| 16234 | 769 |
| 16235 | 765 |
| 16236 | 764 |
| 16237 | 760 |
| 16238 | 757 |
| 16239 | 755 |
| 16240 | 762 |
| 16241 | 756 |
| 16242 | 761 |
| 16243 | 742 |
| 16244 | 732 |
| 16245 | 736 |
| 16246 | 742 |
| 16247 | 748 |
| 16248 | 790 |
| 16249 | 795 |
| 16250 | 795 |
| 16251 | 817 |
| 16252 | 857 |
| 16253 | 860 |
| 16254 | 885 |
| 16255 | 891 |
| 16256 | 919 |
| 16257 | 942 |
| 16258 | 936 |
| 16259 | 952 |
| 16260 | 981 |
| 16261 | 968 |
| 16262 | 958 |
| 16263 | 968 |
| 16264 | 979 |
| 16265 | 977 |
| 16266 | 941 |
| 16267 | 926 |
| 16268 | 964 |
| 16269 | 984 |
| 16270 | 1047 |
| 16271 | 1060 |
| 16272 | 1050 |
| 16273 | 1043 |
| 16274 | 1014 |
| 16275 | 1072 |
| 16276 | 1090 |
| 16277 | 1032 |
| 16278 | 983 |
| 16279 | 989 |
| 16280 | 991 |
| 16281 | 1001 |
| 16282 | 959 |
| 16283 | 923 |
| 16284 | 929 |
| 16285 | 1012 |
| 16286 | 1052 |
| 16287 | 1059 |
| 16288 | 1053 |
| 16289 | 1043 |
| 16290 | 1022 |
| 16291 | 1006 |
| 16292 | 1022 |
| 16293 | 1003 |
| 16294 | 981 |
| 16295 | 1036 |
| 16296 | 1075 |
| 16297 | 1122 |
| 16298 | 1176 |
| 16299 | 1192 |
| 16300 | 1227 |
| 16301 | 1233 |
| 16302 | 1260 |
| 16303 | 1284 |
| 16304 | 1298 |
| 16305 | 1289 |
| 16306 | 1271 |
| 16307 | 1258 |
| 16308 | 1257 |
| 16309 | 1249 |
| 16310 | 1235 |
| 16311 | 1253 |
| 16312 | 1263 |
| 16313 | 1243 |
| 16314 | 1205 |
| 16315 | 1173 |
| 16316 | 1141 |
| 16317 | 1105 |
| 16318 | 1061 |
| 16319 | 1007 |
| 16320 | 968 |
| 16321 | 934 |
| 16322 | 901 |
| 16323 | 880 |
| 16324 | 854 |
| 16325 | 828 |
| 16326 | 808 |
| 16327 | 790 |
| 16328 | 777 |
| 16329 | 759 |
| 16330 | 745 |
| 16331 | 740 |
| 16332 | 738 |
| 16333 | 725 |
| 16334 | 720 |
| 16335 | 715 |
| 16336 | 718 |
| 16337 | 712 |
| 16338 | 714 |
| 16339 | 697 |
| 16340 | 694 |
| 16341 | 673 |
| 16342 | 669 |
| 16343 | 664 |
| 16344 | 663 |
| 16345 | 656 |
| 16346 | 649 |
| 16347 | 648 |
| 16348 | 664 |
| 16349 | 674 |
| 16350 | 683 |
| 16351 | 692 |
| 16352 | 698 |
| 16353 | 713 |
| 16354 | 719 |
| 16355 | 732 |
| 16356 | 751 |
| 16357 | 775 |
| 16358 | 817 |
| 16359 | 794 |
| 16360 | 803 |
| 16361 | 785 |
| 16362 | 766 |
| 16363 | 797 |
| 16364 | 819 |
| 16365 | 914 |
| 16366 | 943 |
| 16367 | 913 |
| 16368 | 873 |
| 16369 | 831 |
| 16370 | 792 |
| 16371 | 791 |
| 16372 | 789 |
| 16373 | 828 |
| 16374 | 756 |
| 16375 | 837 |
| 16376 | 797 |
| 16377 | 707 |
| 16378 | 712 |
| 16379 | 704 |
| 16380 | 627 |
| 16381 | 628 |
| 16382 | 549 |
| 16383 | 511 |
| 16384 | 533 |
| 16385 | 575 |
| 16386 | 608 |
| 16387 | 642 |
| 16388 | 739 |
| 16389 | 825 |
| 16390 | 912 |
| 16391 | 909 |
| 16392 | 919 |
| 16393 | 1003 |
| 16394 | 1081 |
| 16395 | 1149 |
| 16396 | 1227 |
| 16397 | 1250 |
| 16398 | 1242 |
| 16399 | 1267 |
| 16400 | 1278 |
| 16401 | 1278 |
| 16402 | 1271 |
| 16403 | 1257 |
| 16404 | 1257 |
| 16405 | 1248 |
| 16406 | 1235 |
| 16407 | 1236 |
| 16408 | 1251 |
| 16409 | 1238 |
| 16410 | 1190 |
| 16411 | 1131 |
| 16412 | 1058 |
| 16413 | 1006 |
| 16414 | 951 |
| 16415 | 910 |
| 16416 | 883 |
| 16417 | 852 |
| 16418 | 819 |
| 16419 | 796 |
| 16420 | 772 |
| 16421 | 754 |
| 16422 | 739 |
| 16423 | 728 |
| 16424 | 715 |
| 16425 | 701 |
| 16426 | 694 |
| 16427 | 692 |
| 16428 | 697 |
| 16429 | 695 |
| 16430 | 699 |
| 16431 | 701 |
| 16432 | 725 |
| 16433 | 742 |
| 16434 | 759 |
| 16435 | 760 |
| 16436 | 794 |
| 16437 | 802 |
| 16438 | 835 |
| 16439 | 887 |
| 16440 | 964 |
| 16441 | 1011 |
| 16442 | 1052 |
| 16443 | 1095 |
| 16444 | 1141 |
| 16445 | 1140 |
| 16446 | 1140 |
| 16447 | 1156 |
| 16448 | 1170 |
| 16449 | 1170 |
| 16450 | 1157 |
| 16451 | 1117 |
| 16452 | 1059 |
| 16453 | 994 |
| 16454 | 949 |
| 16455 | 941 |
| 16456 | 926 |
| 16457 | 887 |
| 16458 | 870 |
| 16459 | 873 |
| 16460 | 893 |
| 16461 | 961 |
| 16462 | 986 |
| 16463 | 1000 |
| 16464 | 1005 |
| 16465 | 894 |
| 16466 | 873 |
| 16467 | 821 |
| 16468 | 790 |
| 16469 | 889 |
| 16470 | 816 |
| 16471 | 699 |
| 16472 | 748 |
| 16473 | 732 |
| 16474 | 698 |
| 16475 | 655 |
| 16476 | 656 |
| 16477 | 670 |
| 16478 | 682 |
| 16479 | 697 |
| 16480 | 724 |
| 16481 | 760 |
| 16482 | 759 |
| 16483 | 838 |
| 16484 | 894 |
| 16485 | 965 |
| 16486 | 1041 |
| 16487 | 1115 |
| 16488 | 1190 |
| 16489 | 1261 |
| 16490 | 1314 |
| 16491 | 1363 |
| 16492 | 1348 |
| 16493 | 1308 |
| 16494 | 1318 |
| 16495 | 1355 |
| 16496 | 1375 |
| 16497 | 1379 |
| 16498 | 1374 |
| 16499 | 1369 |
| 16500 | 1366 |
| 16501 | 1356 |
| 16502 | 1346 |
| 16503 | 1338 |
| 16504 | 1337 |
| 16505 | 1302 |
| 16506 | 1252 |
| 16507 | 1213 |
| 16508 | 1128 |
| 16509 | 1069 |
| 16510 | 1023 |
| 16511 | 990 |
| 16512 | 959 |
| 16513 | 930 |
| 16514 | 900 |
| 16515 | 865 |
| 16516 | 831 |
| 16517 | 805 |
| 16518 | 789 |
| 16519 | 775 |
| 16520 | 765 |
| 16521 | 752 |
| 16522 | 747 |
| 16523 | 743 |
| 16524 | 744 |
| 16525 | 736 |
| 16526 | 738 |
| 16527 | 743 |
| 16528 | 763 |
| 16529 | 769 |
| 16530 | 788 |
| 16531 | 794 |
| 16532 | 813 |
| 16533 | 821 |
| 16534 | 849 |
| 16535 | 892 |
| 16536 | 978 |
| 16537 | 1020 |
| 16538 | 1046 |
| 16539 | 1071 |
| 16540 | 1127 |
| 16541 | 1130 |
| 16542 | 1140 |
| 16543 | 1141 |
| 16544 | 1147 |
| 16545 | 1128 |
| 16546 | 1103 |
| 16547 | 1085 |
| 16548 | 1043 |
| 16549 | 1009 |
| 16550 | 981 |
| 16551 | 968 |
| 16552 | 976 |
| 16553 | 932 |
| 16554 | 905 |
| 16555 | 890 |
| 16556 | 874 |
| 16557 | 876 |
| 16558 | 884 |
| 16559 | 892 |
| 16560 | 877 |
| 16561 | 844 |
| 16562 | 851 |
| 16563 | 816 |
| 16564 | 821 |
| 16565 | 820 |
| 16566 | 800 |
| 16567 | 804 |
| 16568 | 808 |
| 16569 | 871 |
| 16570 | 870 |
| 16571 | 871 |
| 16572 | 832 |
| 16573 | 824 |
| 16574 | 865 |
| 16575 | 860 |
| 16576 | 873 |
| 16577 | 879 |
| 16578 | 975 |
| 16579 | 964 |
| 16580 | 954 |
| 16581 | 966 |
| 16582 | 995 |
| 16583 | 1035 |
| 16584 | 1103 |
| 16585 | 1146 |
| 16586 | 1212 |
| 16587 | 1284 |
| 16588 | 1316 |
| 16589 | 1338 |
| 16590 | 1364 |
| 16591 | 1389 |
| 16592 | 1414 |
| 16593 | 1430 |
| 16594 | 1426 |
| 16595 | 1433 |
| 16596 | 1416 |
| 16597 | 1393 |
| 16598 | 1378 |
| 16599 | 1354 |
| 16600 | 1347 |
| 16601 | 1319 |
| 16602 | 1260 |
| 16603 | 1199 |
| 16604 | 1120 |
| 16605 | 1046 |
| 16606 | 992 |
| 16607 | 946 |
| 16608 | 915 |
| 16609 | 879 |
| 16610 | 845 |
| 16611 | 815 |
| 16612 | 797 |
| 16613 | 781 |
| 16614 | 769 |
| 16615 | 759 |
| 16616 | 750 |
| 16617 | 743 |
| 16618 | 740 |
| 16619 | 737 |
| 16620 | 739 |
| 16621 | 737 |
| 16622 | 738 |
| 16623 | 744 |
| 16624 | 766 |
| 16625 | 771 |
| 16626 | 786 |
| 16627 | 788 |
| 16628 | 801 |
| 16629 | 820 |
| 16630 | 852 |
| 16631 | 896 |
| 16632 | 983 |
| 16633 | 1026 |
| 16634 | 1068 |
| 16635 | 1103 |
| 16636 | 1148 |
| 16637 | 1148 |
| 16638 | 1149 |
| 16639 | 1151 |
| 16640 | 1159 |
| 16641 | 1138 |
| 16642 | 1120 |
| 16643 | 1085 |
| 16644 | 1007 |
| 16645 | 955 |
| 16646 | 926 |
| 16647 | 875 |
| 16648 | 842 |
| 16649 | 844 |
| 16650 | 843 |
| 16651 | 831 |
| 16652 | 816 |
| 16653 | 819 |
| 16654 | 837 |
| 16655 | 827 |
| 16656 | 820 |
| 16657 | 804 |
| 16658 | 776 |
| 16659 | 724 |
| 16660 | 730 |
| 16661 | 687 |
| 16662 | 666 |
| 16663 | 670 |
| 16664 | 654 |
| 16665 | 617 |
| 16666 | 619 |
| 16667 | 643 |
| 16668 | 668 |
| 16669 | 619 |
| 16670 | 627 |
| 16671 | 681 |
| 16672 | 723 |
| 16673 | 722 |
| 16674 | 718 |
| 16675 | 763 |
| 16676 | 798 |
| 16677 | 838 |
| 16678 | 901 |
| 16679 | 975 |
| 16680 | 1045 |
| 16681 | 1116 |
| 16682 | 1153 |
| 16683 | 1190 |
| 16684 | 1227 |
| 16685 | 1250 |
| 16686 | 1261 |
| 16687 | 1284 |
| 16688 | 1310 |
| 16689 | 1322 |
| 16690 | 1322 |
| 16691 | 1335 |
| 16692 | 1332 |
| 16693 | 1323 |
| 16694 | 1314 |
| 16695 | 1323 |
| 16696 | 1326 |
| 16697 | 1304 |
| 16698 | 1247 |
| 16699 | 1185 |
| 16700 | 1118 |
| 16701 | 1057 |
| 16702 | 998 |
| 16703 | 950 |
| 16704 | 917 |
| 16705 | 878 |
| 16706 | 845 |
| 16707 | 829 |
| 16708 | 810 |
| 16709 | 796 |
| 16710 | 779 |
| 16711 | 763 |
| 16712 | 755 |
| 16713 | 749 |
| 16714 | 743 |
| 16715 | 743 |
| 16716 | 743 |
| 16717 | 742 |
| 16718 | 743 |
| 16719 | 743 |
| 16720 | 757 |
| 16721 | 758 |
| 16722 | 770 |
| 16723 | 762 |
| 16724 | 772 |
| 16725 | 779 |
| 16726 | 802 |
| 16727 | 824 |
| 16728 | 878 |
| 16729 | 900 |
| 16730 | 914 |
| 16731 | 917 |
| 16732 | 958 |
| 16733 | 957 |
| 16734 | 954 |
| 16735 | 966 |
| 16736 | 977 |
| 16737 | 969 |
| 16738 | 923 |
| 16739 | 897 |
| 16740 | 874 |
| 16741 | 849 |
| 16742 | 867 |
| 16743 | 861 |
| 16744 | 815 |
| 16745 | 792 |
| 16746 | 816 |
| 16747 | 834 |
| 16748 | 858 |
| 16749 | 878 |
| 16750 | 869 |
| 16751 | 843 |
| 16752 | 815 |
| 16753 | 756 |
| 16754 | 708 |
| 16755 | 669 |
| 16756 | 621 |
| 16757 | 590 |
| 16758 | 589 |
| 16759 | 548 |
| 16760 | 552 |
| 16761 | 492 |
| 16762 | 443 |
| 16763 | 435 |
| 16764 | 426 |
| 16765 | 472 |
| 16766 | 474 |
| 16767 | 508 |
| 16768 | 556 |
| 16769 | 620 |
| 16770 | 672 |
| 16771 | 669 |
| 16772 | 706 |
| 16773 | 781 |
| 16774 | 898 |
| 16775 | 999 |
| 16776 | 1047 |
| 16777 | 1047 |
| 16778 | 1129 |
| 16779 | 1200 |
| 16780 | 1207 |
| 16781 | 1202 |
| 16782 | 1214 |
| 16783 | 1240 |
| 16784 | 1273 |
| 16785 | 1287 |
| 16786 | 1292 |
| 16787 | 1302 |
| 16788 | 1299 |
| 16789 | 1290 |
| 16790 | 1291 |
| 16791 | 1313 |
| 16792 | 1312 |
| 16793 | 1288 |
| 16794 | 1234 |
| 16795 | 1175 |
| 16796 | 1102 |
| 16797 | 1038 |
| 16798 | 984 |
| 16799 | 936 |
| 16800 | 905 |
| 16801 | 872 |
| 16802 | 839 |
| 16803 | 814 |
| 16804 | 792 |
| 16805 | 775 |
| 16806 | 765 |
| 16807 | 756 |
| 16808 | 747 |
| 16809 | 742 |
| 16810 | 738 |
| 16811 | 734 |
| 16812 | 734 |
| 16813 | 732 |
| 16814 | 732 |
| 16815 | 734 |
| 16816 | 758 |
| 16817 | 763 |
| 16818 | 775 |
| 16819 | 778 |
| 16820 | 783 |
| 16821 | 792 |
| 16822 | 817 |
| 16823 | 861 |
| 16824 | 937 |
| 16825 | 965 |
| 16826 | 999 |
| 16827 | 1037 |
| 16828 | 1079 |
| 16829 | 1103 |
| 16830 | 1110 |
| 16831 | 1114 |
| 16832 | 1126 |
| 16833 | 1116 |
| 16834 | 1081 |
| 16835 | 1004 |
| 16836 | 995 |
| 16837 | 982 |
| 16838 | 972 |
| 16839 | 1025 |
| 16840 | 992 |
| 16841 | 942 |
| 16842 | 923 |
| 16843 | 897 |
| 16844 | 868 |
| 16845 | 871 |
| 16846 | 889 |
| 16847 | 872 |
| 16848 | 841 |
| 16849 | 807 |
| 16850 | 816 |
| 16851 | 799 |
| 16852 | 799 |
| 16853 | 819 |
| 16854 | 842 |
| 16855 | 836 |
| 16856 | 861 |
| 16857 | 827 |
| 16858 | 799 |
| 16859 | 763 |
| 16860 | 704 |
| 16861 | 689 |
| 16862 | 721 |
| 16863 | 848 |
| 16864 | 963 |
| 16865 | 983 |
| 16866 | 907 |
| 16867 | 895 |
| 16868 | 1023 |
| 16869 | 1107 |
| 16870 | 1142 |
| 16871 | 1196 |
| 16872 | 1195 |
| 16873 | 1228 |
| 16874 | 1298 |
| 16875 | 1321 |
| 16876 | 1347 |
| 16877 | 1334 |
| 16878 | 1322 |
| 16879 | 1320 |
| 16880 | 1352 |
| 16881 | 1367 |
| 16882 | 1360 |
| 16883 | 1361 |
| 16884 | 1346 |
| 16885 | 1327 |
| 16886 | 1312 |
| 16887 | 1308 |
| 16888 | 1333 |
| 16889 | 1308 |
| 16890 | 1260 |
| 16891 | 1209 |
| 16892 | 1148 |
| 16893 | 1097 |
| 16894 | 1047 |
| 16895 | 1005 |
| 16896 | 971 |
| 16897 | 936 |
| 16898 | 890 |
| 16899 | 864 |
| 16900 | 844 |
| 16901 | 828 |
| 16902 | 809 |
| 16903 | 797 |
| 16904 | 788 |
| 16905 | 773 |
| 16906 | 766 |
| 16907 | 760 |
| 16908 | 759 |
| 16909 | 753 |
| 16910 | 747 |
| 16911 | 744 |
| 16912 | 750 |
| 16913 | 743 |
| 16914 | 748 |
| 16915 | 744 |
| 16916 | 726 |
| 16917 | 726 |
| 16918 | 738 |
| 16919 | 751 |
| 16920 | 803 |
| 16921 | 814 |
| 16922 | 825 |
| 16923 | 840 |
| 16924 | 878 |
| 16925 | 895 |
| 16926 | 932 |
| 16927 | 948 |
| 16928 | 977 |
| 16929 | 1014 |
| 16930 | 1024 |
| 16931 | 1057 |
| 16932 | 1088 |
| 16933 | 1104 |
| 16934 | 1116 |
| 16935 | 1117 |
| 16936 | 1102 |
| 16937 | 1113 |
| 16938 | 1056 |
| 16939 | 1010 |
| 16940 | 1030 |
| 16941 | 1022 |
| 16942 | 1025 |
| 16943 | 1019 |
| 16944 | 1039 |
| 16945 | 1021 |
| 16946 | 977 |
| 16947 | 1012 |
| 16948 | 996 |
| 16949 | 896 |
| 16950 | 861 |
| 16951 | 858 |
| 16952 | 891 |
| 16953 | 939 |
| 16954 | 970 |
| 16955 | 1002 |
| 16956 | 1011 |
| 16957 | 1017 |
| 16958 | 1006 |
| 16959 | 1008 |
| 16960 | 1032 |
| 16961 | 1055 |
| 16962 | 1065 |
| 16963 | 1087 |
| 16964 | 1137 |
| 16965 | 1122 |
| 16966 | 1118 |
| 16967 | 1173 |
| 16968 | 1211 |
| 16969 | 1228 |
| 16970 | 1259 |
| 16971 | 1272 |
| 16972 | 1297 |
| 16973 | 1298 |
| 16974 | 1309 |
| 16975 | 1317 |
| 16976 | 1326 |
| 16977 | 1310 |
| 16978 | 1294 |
| 16979 | 1284 |
| 16980 | 1283 |
| 16981 | 1268 |
| 16982 | 1257 |
| 16983 | 1280 |
| 16984 | 1270 |
| 16985 | 1243 |
| 16986 | 1207 |
| 16987 | 1174 |
| 16988 | 1141 |
| 16989 | 1100 |
| 16990 | 1055 |
| 16991 | 1009 |
| 16992 | 974 |
| 16993 | 943 |
| 16994 | 914 |
| 16995 | 885 |
| 16996 | 853 |
| 16997 | 820 |
| 16998 | 798 |
| 16999 | 778 |
| 17000 | 769 |
| 17001 | 754 |
| 17002 | 747 |
| 17003 | 742 |
| 17004 | 742 |
| 17005 | 730 |
| 17006 | 722 |
| 17007 | 717 |
| 17008 | 720 |
| 17009 | 717 |
| 17010 | 716 |
| 17011 | 709 |
| 17012 | 696 |
| 17013 | 676 |
| 17014 | 676 |
| 17015 | 673 |
| 17016 | 675 |
| 17017 | 669 |
| 17018 | 666 |
| 17019 | 663 |
| 17020 | 687 |
| 17021 | 697 |
| 17022 | 709 |
| 17023 | 709 |
| 17024 | 732 |
| 17025 | 746 |
| 17026 | 744 |
| 17027 | 753 |
| 17028 | 776 |
| 17029 | 817 |
| 17030 | 873 |
| 17031 | 843 |
| 17032 | 823 |
| 17033 | 813 |
| 17034 | 842 |
| 17035 | 845 |
| 17036 | 842 |
| 17037 | 921 |
| 17038 | 930 |
| 17039 | 919 |
| 17040 | 910 |
| 17041 | 868 |
| 17042 | 825 |
| 17043 | 772 |
| 17044 | 740 |
| 17045 | 764 |
| 17046 | 748 |
| 17047 | 779 |
| 17048 | 761 |
| 17049 | 684 |
| 17050 | 710 |
| 17051 | 702 |
| 17052 | 662 |
| 17053 | 658 |
| 17054 | 647 |
| 17055 | 646 |
| 17056 | 633 |
| 17057 | 674 |
| 17058 | 689 |
| 17059 | 720 |
| 17060 | 766 |
| 17061 | 846 |
| 17062 | 869 |
| 17063 | 862 |
| 17064 | 879 |
| 17065 | 959 |
| 17066 | 1057 |
| 17067 | 1127 |
| 17068 | 1195 |
| 17069 | 1211 |
| 17070 | 1211 |
| 17071 | 1251 |
| 17072 | 1269 |
| 17073 | 1275 |
| 17074 | 1270 |
| 17075 | 1263 |
| 17076 | 1259 |
| 17077 | 1249 |
| 17078 | 1235 |
| 17079 | 1236 |
| 17080 | 1261 |
| 17081 | 1237 |
| 17082 | 1169 |
| 17083 | 1114 |
| 17084 | 1047 |
| 17085 | 999 |
| 17086 | 943 |
| 17087 | 903 |
| 17088 | 878 |
| 17089 | 844 |
| 17090 | 813 |
| 17091 | 796 |
| 17092 | 772 |
| 17093 | 750 |
| 17094 | 739 |
| 17095 | 727 |
| 17096 | 718 |
| 17097 | 704 |
| 17098 | 703 |
| 17099 | 700 |
| 17100 | 700 |
| 17101 | 695 |
| 17102 | 697 |
| 17103 | 699 |
| 17104 | 723 |
| 17105 | 740 |
| 17106 | 758 |
| 17107 | 773 |
| 17108 | 808 |
| 17109 | 804 |
| 17110 | 836 |
| 17111 | 894 |
| 17112 | 974 |
| 17113 | 1018 |
| 17114 | 1055 |
| 17115 | 1115 |
| 17116 | 1173 |
| 17117 | 1188 |
| 17118 | 1206 |
| 17119 | 1226 |
| 17120 | 1247 |
| 17121 | 1265 |
| 17122 | 1271 |
| 17123 | 1246 |
| 17124 | 1188 |
| 17125 | 1116 |
| 17126 | 1081 |
| 17127 | 1075 |
| 17128 | 1079 |
| 17129 | 1039 |
| 17130 | 1010 |
| 17131 | 984 |
| 17132 | 973 |
| 17133 | 1011 |
| 17134 | 961 |
| 17135 | 897 |
| 17136 | 902 |
| 17137 | 784 |
| 17138 | 754 |
| 17139 | 749 |
| 17140 | 714 |
| 17141 | 780 |
| 17142 | 697 |
| 17143 | 617 |
| 17144 | 735 |
| 17145 | 750 |
| 17146 | 718 |
| 17147 | 652 |
| 17148 | 670 |
| 17149 | 719 |
| 17150 | 758 |
| 17151 | 795 |
| 17152 | 773 |
| 17153 | 776 |
| 17154 | 786 |
| 17155 | 867 |
| 17156 | 925 |
| 17157 | 967 |
| 17158 | 1043 |
| 17159 | 1119 |
| 17160 | 1225 |
| 17161 | 1305 |
| 17162 | 1374 |
| 17163 | 1411 |
| 17164 | 1395 |
| 17165 | 1360 |
| 17166 | 1367 |
| 17167 | 1386 |
| 17168 | 1396 |
| 17169 | 1391 |
| 17170 | 1387 |
| 17171 | 1383 |
| 17172 | 1368 |
| 17173 | 1358 |
| 17174 | 1349 |
| 17175 | 1349 |
| 17176 | 1347 |
| 17177 | 1307 |
| 17178 | 1252 |
| 17179 | 1210 |
| 17180 | 1127 |
| 17181 | 1068 |
| 17182 | 1022 |
| 17183 | 987 |
| 17184 | 954 |
| 17185 | 922 |
| 17186 | 886 |
| 17187 | 848 |
| 17188 | 817 |
| 17189 | 788 |
| 17190 | 772 |
| 17191 | 763 |
| 17192 | 754 |
| 17193 | 742 |
| 17194 | 743 |
| 17195 | 739 |
| 17196 | 749 |
| 17197 | 747 |
| 17198 | 751 |
| 17199 | 753 |
| 17200 | 768 |
| 17201 | 774 |
| 17202 | 788 |
| 17203 | 794 |
| 17204 | 822 |
| 17205 | 824 |
| 17206 | 848 |
| 17207 | 894 |
| 17208 | 981 |
| 17209 | 1024 |
| 17210 | 1048 |
| 17211 | 1084 |
| 17212 | 1151 |
| 17213 | 1168 |
| 17214 | 1181 |
| 17215 | 1181 |
| 17216 | 1198 |
| 17217 | 1176 |
| 17218 | 1159 |
| 17219 | 1146 |
| 17220 | 1113 |
| 17221 | 1094 |
| 17222 | 1076 |
| 17223 | 1057 |
| 17224 | 1068 |
| 17225 | 1029 |
| 17226 | 991 |
| 17227 | 978 |
| 17228 | 979 |
| 17229 | 985 |
| 17230 | 1025 |
| 17231 | 1034 |
| 17232 | 1019 |
| 17233 | 975 |
| 17234 | 959 |
| 17235 | 925 |
| 17236 | 950 |
| 17237 | 950 |
| 17238 | 934 |
| 17239 | 936 |
| 17240 | 920 |
| 17241 | 980 |
| 17242 | 972 |
| 17243 | 981 |
| 17244 | 974 |
| 17245 | 983 |
| 17246 | 973 |
| 17247 | 980 |
| 17248 | 1020 |
| 17249 | 1042 |
| 17250 | 1103 |
| 17251 | 1081 |
| 17252 | 1085 |
| 17253 | 1131 |
| 17254 | 1166 |
| 17255 | 1224 |
| 17256 | 1298 |
| 17257 | 1329 |
| 17258 | 1368 |
| 17259 | 1431 |
| 17260 | 1450 |
| 17261 | 1461 |
| 17262 | 1473 |
| 17263 | 1479 |
| 17264 | 1488 |
| 17265 | 1491 |
| 17266 | 1474 |
| 17267 | 1463 |
| 17268 | 1441 |
| 17269 | 1423 |
| 17270 | 1413 |
| 17271 | 1382 |
| 17272 | 1349 |
| 17273 | 1309 |
| 17274 | 1254 |
| 17275 | 1215 |
| 17276 | 1139 |
| 17277 | 1072 |
| 17278 | 1029 |
| 17279 | 996 |
| 17280 | 968 |
| 17281 | 927 |
| 17282 | 882 |
| 17283 | 843 |
| 17284 | 815 |
| 17285 | 791 |
| 17286 | 780 |
| 17287 | 769 |
| 17288 | 756 |
| 17289 | 744 |
| 17290 | 742 |
| 17291 | 740 |
| 17292 | 739 |
| 17293 | 735 |
| 17294 | 734 |
| 17295 | 737 |
| 17296 | 755 |
| 17297 | 760 |
| 17298 | 777 |
| 17299 | 790 |
| 17300 | 809 |
| 17301 | 822 |
| 17302 | 859 |
| 17303 | 904 |
| 17304 | 990 |
| 17305 | 1033 |
| 17306 | 1083 |
| 17307 | 1129 |
| 17308 | 1184 |
| 17309 | 1203 |
| 17310 | 1221 |
| 17311 | 1239 |
| 17312 | 1268 |
| 17313 | 1274 |
| 17314 | 1279 |
| 17315 | 1261 |
| 17316 | 1202 |
| 17317 | 1175 |
| 17318 | 1148 |
| 17319 | 1104 |
| 17320 | 1082 |
| 17321 | 1096 |
| 17322 | 1093 |
| 17323 | 1108 |
| 17324 | 1087 |
| 17325 | 1076 |
| 17326 | 1083 |
| 17327 | 1111 |
| 17328 | 1075 |
| 17329 | 1061 |
| 17330 | 1011 |
| 17331 | 944 |
| 17332 | 949 |
| 17333 | 904 |
| 17334 | 906 |
| 17335 | 909 |
| 17336 | 895 |
| 17337 | 873 |
| 17338 | 876 |
| 17339 | 881 |
| 17340 | 885 |
| 17341 | 869 |
| 17342 | 875 |
| 17343 | 895 |
| 17344 | 934 |
| 17345 | 927 |
| 17346 | 888 |
| 17347 | 936 |
| 17348 | 985 |
| 17349 | 1033 |
| 17350 | 1091 |
| 17351 | 1160 |
| 17352 | 1230 |
| 17353 | 1289 |
| 17354 | 1313 |
| 17355 | 1329 |
| 17356 | 1354 |
| 17357 | 1385 |
| 17358 | 1397 |
| 17359 | 1414 |
| 17360 | 1424 |
| 17361 | 1423 |
| 17362 | 1405 |
| 17363 | 1407 |
| 17364 | 1396 |
| 17365 | 1389 |
| 17366 | 1393 |
| 17367 | 1382 |
| 17368 | 1364 |
| 17369 | 1333 |
| 17370 | 1268 |
| 17371 | 1208 |
| 17372 | 1130 |
| 17373 | 1066 |
| 17374 | 1016 |
| 17375 | 972 |
| 17376 | 943 |
| 17377 | 904 |
| 17378 | 876 |
| 17379 | 851 |
| 17380 | 819 |
| 17381 | 799 |
| 17382 | 782 |
| 17383 | 767 |
| 17384 | 763 |
| 17385 | 755 |
| 17386 | 750 |
| 17387 | 747 |
| 17388 | 748 |
| 17389 | 745 |
| 17390 | 746 |
| 17391 | 749 |
| 17392 | 767 |
| 17393 | 773 |
| 17394 | 790 |
| 17395 | 800 |
| 17396 | 821 |
| 17397 | 822 |
| 17398 | 852 |
| 17399 | 898 |
| 17400 | 984 |
| 17401 | 1032 |
| 17402 | 1066 |
| 17403 | 1091 |
| 17404 | 1154 |
| 17405 | 1153 |
| 17406 | 1156 |
| 17407 | 1167 |
| 17408 | 1196 |
| 17409 | 1193 |
| 17410 | 1149 |
| 17411 | 1136 |
| 17412 | 1118 |
| 17413 | 1100 |
| 17414 | 1089 |
| 17415 | 1078 |
| 17416 | 1072 |
| 17417 | 1033 |
| 17418 | 1047 |
| 17419 | 1059 |
| 17420 | 1072 |
| 17421 | 1120 |
| 17422 | 1110 |
| 17423 | 1090 |
| 17424 | 1070 |
| 17425 | 1064 |
| 17426 | 1024 |
| 17427 | 987 |
| 17428 | 949 |
| 17429 | 955 |
| 17430 | 970 |
| 17431 | 940 |
| 17432 | 919 |
| 17433 | 858 |
| 17434 | 838 |
| 17435 | 818 |
| 17436 | 803 |
| 17437 | 822 |
| 17438 | 794 |
| 17439 | 763 |
| 17440 | 738 |
| 17441 | 713 |
| 17442 | 774 |
| 17443 | 814 |
| 17444 | 905 |
| 17445 | 952 |
| 17446 | 1006 |
| 17447 | 1093 |
| 17448 | 1192 |
| 17449 | 1247 |
| 17450 | 1314 |
| 17451 | 1387 |
| 17452 | 1399 |
| 17453 | 1403 |
| 17454 | 1401 |
| 17455 | 1407 |
| 17456 | 1426 |
| 17457 | 1420 |
| 17458 | 1403 |
| 17459 | 1397 |
| 17460 | 1385 |
| 17461 | 1356 |
| 17462 | 1345 |
| 17463 | 1350 |
| 17464 | 1343 |
| 17465 | 1314 |
| 17466 | 1256 |
| 17467 | 1188 |
| 17468 | 1108 |
| 17469 | 1047 |
| 17470 | 995 |
| 17471 | 946 |
| 17472 | 916 |
| 17473 | 878 |
| 17474 | 844 |
| 17475 | 819 |
| 17476 | 799 |
| 17477 | 785 |
| 17478 | 776 |
| 17479 | 768 |
| 17480 | 758 |
| 17481 | 752 |
| 17482 | 747 |
| 17483 | 746 |
| 17484 | 747 |
| 17485 | 743 |
| 17486 | 744 |
| 17487 | 744 |
| 17488 | 768 |
| 17489 | 772 |
| 17490 | 787 |
| 17491 | 795 |
| 17492 | 810 |
| 17493 | 814 |
| 17494 | 846 |
| 17495 | 897 |
| 17496 | 978 |
| 17497 | 1017 |
| 17498 | 1047 |
| 17499 | 1077 |
| 17500 | 1118 |
| 17501 | 1134 |
| 17502 | 1132 |
| 17503 | 1130 |
| 17504 | 1138 |
| 17505 | 1122 |
| 17506 | 1091 |
| 17507 | 1040 |
| 17508 | 994 |
| 17509 | 957 |
| 17510 | 949 |
| 17511 | 946 |
| 17512 | 910 |
| 17513 | 854 |
| 17514 | 802 |
| 17515 | 784 |
| 17516 | 762 |
| 17517 | 745 |
| 17518 | 771 |
| 17519 | 784 |
| 17520 | 766 |
| 17521 | 728 |
| 17522 | 697 |
| 17523 | 640 |
| 17524 | 639 |
| 17525 | 668 |
| 17526 | 664 |
| 17527 | 663 |
| 17528 | 727 |
| 17529 | 726 |
| 17530 | 714 |
| 17531 | 675 |
| 17532 | 657 |
| 17533 | 676 |
| 17534 | 825 |
| 17535 | 967 |
| 17536 | 1063 |
| 17537 | 1091 |
| 17538 | 1061 |
| 17539 | 1035 |
| 17540 | 1110 |
| 17541 | 1191 |
| 17542 | 1215 |
| 17543 | 1269 |
| 17544 | 1280 |
| 17545 | 1318 |
| 17546 | 1354 |
| 17547 | 1351 |
| 17548 | 1371 |
| 17549 | 1373 |
| 17550 | 1365 |
| 17551 | 1361 |
| 17552 | 1382 |
| 17553 | 1385 |
| 17554 | 1368 |
| 17555 | 1363 |
| 17556 | 1353 |
| 17557 | 1336 |
| 17558 | 1320 |
| 17559 | 1321 |
| 17560 | 1345 |
| 17561 | 1316 |
| 17562 | 1262 |
| 17563 | 1205 |
| 17564 | 1143 |
| 17565 | 1095 |
| 17566 | 1050 |
| 17567 | 1009 |
| 17568 | 976 |
| 17569 | 939 |
| 17570 | 904 |
| 17571 | 870 |
| 17572 | 853 |
| 17573 | 838 |
| 17574 | 820 |
| 17575 | 807 |
| 17576 | 795 |
| 17577 | 779 |
| 17578 | 771 |
| 17579 | 768 |
| 17580 | 765 |
| 17581 | 759 |
| 17582 | 752 |
| 17583 | 749 |
| 17584 | 755 |
| 17585 | 750 |
| 17586 | 756 |
| 17587 | 759 |
| 17588 | 743 |
| 17589 | 735 |
| 17590 | 749 |
| 17591 | 765 |
| 17592 | 811 |
| 17593 | 827 |
| 17594 | 840 |
| 17595 | 856 |
| 17596 | 900 |
| 17597 | 924 |
| 17598 | 959 |
| 17599 | 985 |
| 17600 | 1022 |
| 17601 | 1032 |
| 17602 | 1043 |
| 17603 | 1062 |
| 17604 | 1088 |
| 17605 | 1111 |
| 17606 | 1097 |
| 17607 | 1093 |
| 17608 | 1083 |
| 17609 | 1040 |
| 17610 | 982 |
| 17611 | 934 |
| 17612 | 936 |
| 17613 | 962 |
| 17614 | 973 |
| 17615 | 970 |
| 17616 | 948 |
| 17617 | 951 |
| 17618 | 900 |
| 17619 | 868 |
| 17620 | 841 |
| 17621 | 765 |
| 17622 | 748 |
| 17623 | 734 |
| 17624 | 798 |
| 17625 | 943 |
| 17626 | 994 |
| 17627 | 1009 |
| 17628 | 1010 |
| 17629 | 925 |
| 17630 | 958 |
| 17631 | 993 |
| 17632 | 957 |
| 17633 | 993 |
| 17634 | 1042 |
| 17635 | 1098 |
| 17636 | 1104 |
| 17637 | 1120 |
| 17638 | 1176 |
| 17639 | 1270 |
| 17640 | 1255 |
| 17641 | 1240 |
| 17642 | 1263 |
| 17643 | 1305 |
| 17644 | 1350 |
| 17645 | 1350 |
| 17646 | 1350 |
| 17647 | 1345 |
| 17648 | 1345 |
| 17649 | 1334 |
| 17650 | 1317 |
| 17651 | 1307 |
| 17652 | 1314 |
| 17653 | 1309 |
| 17654 | 1300 |
| 17655 | 1321 |
| 17656 | 1302 |
| 17657 | 1269 |
| 17658 | 1231 |
| 17659 | 1196 |
| 17660 | 1143 |
| 17661 | 1095 |
| 17662 | 1051 |
| 17663 | 1012 |
| 17664 | 979 |
| 17665 | 944 |
| 17666 | 913 |
| 17667 | 879 |
| 17668 | 847 |
| 17669 | 814 |
| 17670 | 791 |
| 17671 | 772 |
| 17672 | 763 |
| 17673 | 748 |
| 17674 | 741 |
| 17675 | 735 |
| 17676 | 734 |
| 17677 | 723 |
| 17678 | 714 |
| 17679 | 709 |
| 17680 | 714 |
| 17681 | 710 |
| 17682 | 710 |
| 17683 | 715 |
| 17684 | 708 |
| 17685 | 688 |
| 17686 | 675 |
| 17687 | 678 |
| 17688 | 684 |
| 17689 | 683 |
| 17690 | 685 |
| 17691 | 686 |
| 17692 | 726 |
| 17693 | 751 |
| 17694 | 784 |
| 17695 | 803 |
| 17696 | 854 |
| 17697 | 889 |
| 17698 | 900 |
| 17699 | 911 |
| 17700 | 920 |
| 17701 | 956 |
| 17702 | 1007 |
| 17703 | 998 |
| 17704 | 1019 |
| 17705 | 1042 |
| 17706 | 1079 |
| 17707 | 1068 |
| 17708 | 1104 |
| 17709 | 1151 |
| 17710 | 1153 |
| 17711 | 1161 |
| 17712 | 1123 |
| 17713 | 1063 |
| 17714 | 1029 |
| 17715 | 951 |
| 17716 | 886 |
| 17717 | 873 |
| 17718 | 911 |
| 17719 | 918 |
| 17720 | 951 |
| 17721 | 892 |
| 17722 | 852 |
| 17723 | 857 |
| 17724 | 817 |
| 17725 | 819 |
| 17726 | 781 |
| 17727 | 788 |
| 17728 | 769 |
| 17729 | 819 |
| 17730 | 885 |
| 17731 | 887 |
| 17732 | 918 |
| 17733 | 1013 |
| 17734 | 1033 |
| 17735 | 1020 |
| 17736 | 970 |
| 17737 | 1047 |
| 17738 | 1154 |
| 17739 | 1228 |
| 17740 | 1302 |
| 17741 | 1315 |
| 17742 | 1292 |
| 17743 | 1286 |
| 17744 | 1283 |
| 17745 | 1290 |
| 17746 | 1286 |
| 17747 | 1277 |
| 17748 | 1257 |
| 17749 | 1231 |
| 17750 | 1211 |
| 17751 | 1245 |
| 17752 | 1253 |
| 17753 | 1216 |
| 17754 | 1153 |
| 17755 | 1114 |
| 17756 | 1061 |
| 17757 | 1022 |
| 17758 | 977 |
| 17759 | 946 |
| 17760 | 925 |
| 17761 | 896 |
| 17762 | 861 |
| 17763 | 838 |
| 17764 | 806 |
| 17765 | 771 |
| 17766 | 753 |
| 17767 | 734 |
| 17768 | 725 |
| 17769 | 711 |
| 17770 | 706 |
| 17771 | 703 |
| 17772 | 702 |
| 17773 | 697 |
| 17774 | 695 |
| 17775 | 696 |
| 17776 | 719 |
| 17777 | 732 |
| 17778 | 752 |
| 17779 | 775 |
| 17780 | 812 |
| 17781 | 806 |
| 17782 | 828 |
| 17783 | 888 |
| 17784 | 969 |
| 17785 | 1004 |
| 17786 | 1045 |
| 17787 | 1112 |
| 17788 | 1173 |
| 17789 | 1194 |
| 17790 | 1220 |
| 17791 | 1254 |
| 17792 | 1272 |
| 17793 | 1295 |
| 17794 | 1310 |
| 17795 | 1288 |
| 17796 | 1230 |
| 17797 | 1169 |
| 17798 | 1136 |
| 17799 | 1097 |
| 17800 | 1116 |
| 17801 | 1092 |
| 17802 | 1111 |
| 17803 | 1087 |
| 17804 | 1116 |
| 17805 | 1125 |
| 17806 | 1054 |
| 17807 | 1031 |
| 17808 | 956 |
| 17809 | 833 |
| 17810 | 828 |
| 17811 | 796 |
| 17812 | 730 |
| 17813 | 787 |
| 17814 | 704 |
| 17815 | 619 |
| 17816 | 738 |
| 17817 | 731 |
| 17818 | 692 |
| 17819 | 653 |
| 17820 | 691 |
| 17821 | 765 |
| 17822 | 842 |
| 17823 | 868 |
| 17824 | 821 |
| 17825 | 809 |
| 17826 | 838 |
| 17827 | 892 |
| 17828 | 955 |
| 17829 | 1013 |
| 17830 | 1092 |
| 17831 | 1180 |
| 17832 | 1269 |
| 17833 | 1359 |
| 17834 | 1455 |
| 17835 | 1457 |
| 17836 | 1428 |
| 17837 | 1376 |
| 17838 | 1374 |
| 17839 | 1387 |
| 17840 | 1389 |
| 17841 | 1369 |
| 17842 | 1371 |
| 17843 | 1385 |
| 17844 | 1372 |
| 17845 | 1359 |
| 17846 | 1345 |
| 17847 | 1343 |
| 17848 | 1342 |
| 17849 | 1297 |
| 17850 | 1240 |
| 17851 | 1194 |
| 17852 | 1114 |
| 17853 | 1052 |
| 17854 | 1004 |
| 17855 | 970 |
| 17856 | 938 |
| 17857 | 912 |
| 17858 | 882 |
| 17859 | 845 |
| 17860 | 813 |
| 17861 | 784 |
| 17862 | 769 |
| 17863 | 761 |
| 17864 | 753 |
| 17865 | 745 |
| 17866 | 747 |
| 17867 | 743 |
| 17868 | 750 |
| 17869 | 748 |
| 17870 | 752 |
| 17871 | 752 |
| 17872 | 770 |
| 17873 | 775 |
| 17874 | 789 |
| 17875 | 802 |
| 17876 | 835 |
| 17877 | 825 |
| 17878 | 849 |
| 17879 | 896 |
| 17880 | 978 |
| 17881 | 1026 |
| 17882 | 1052 |
| 17883 | 1090 |
| 17884 | 1158 |
| 17885 | 1183 |
| 17886 | 1205 |
| 17887 | 1206 |
| 17888 | 1225 |
| 17889 | 1214 |
| 17890 | 1188 |
| 17891 | 1174 |
| 17892 | 1143 |
| 17893 | 1130 |
| 17894 | 1110 |
| 17895 | 1083 |
| 17896 | 1092 |
| 17897 | 1056 |
| 17898 | 1023 |
| 17899 | 1019 |
| 17900 | 1041 |
| 17901 | 1042 |
| 17902 | 1078 |
| 17903 | 1099 |
| 17904 | 1067 |
| 17905 | 1024 |
| 17906 | 992 |
| 17907 | 963 |
| 17908 | 1020 |
| 17909 | 1020 |
| 17910 | 980 |
| 17911 | 967 |
| 17912 | 935 |
| 17913 | 966 |
| 17914 | 934 |
| 17915 | 950 |
| 17916 | 928 |
| 17917 | 949 |
| 17918 | 962 |
| 17919 | 951 |
| 17920 | 970 |
| 17921 | 971 |
| 17922 | 996 |
| 17923 | 995 |
| 17924 | 1040 |
| 17925 | 1115 |
| 17926 | 1177 |
| 17927 | 1236 |
| 17928 | 1272 |
| 17929 | 1303 |
| 17930 | 1346 |
| 17931 | 1395 |
| 17932 | 1412 |
| 17933 | 1427 |
| 17934 | 1442 |
| 17935 | 1445 |
| 17936 | 1441 |
| 17937 | 1441 |
| 17938 | 1425 |
| 17939 | 1422 |
| 17940 | 1409 |
| 17941 | 1398 |
| 17942 | 1394 |
| 17943 | 1376 |
| 17944 | 1351 |
| 17945 | 1305 |
| 17946 | 1250 |
| 17947 | 1212 |
| 17948 | 1139 |
| 17949 | 1079 |
| 17950 | 1033 |
| 17951 | 999 |
| 17952 | 967 |
| 17953 | 925 |
| 17954 | 883 |
| 17955 | 844 |
| 17956 | 815 |
| 17957 | 791 |
| 17958 | 779 |
| 17959 | 767 |
| 17960 | 756 |
| 17961 | 745 |
| 17962 | 743 |
| 17963 | 741 |
| 17964 | 740 |
| 17965 | 732 |
| 17966 | 732 |
| 17967 | 733 |
| 17968 | 751 |
| 17969 | 755 |
| 17970 | 773 |
| 17971 | 789 |
| 17972 | 819 |
| 17973 | 828 |
| 17974 | 857 |
| 17975 | 901 |
| 17976 | 989 |
| 17977 | 1037 |
| 17978 | 1088 |
| 17979 | 1129 |
| 17980 | 1178 |
| 17981 | 1205 |
| 17982 | 1225 |
| 17983 | 1239 |
| 17984 | 1269 |
| 17985 | 1272 |
| 17986 | 1263 |
| 17987 | 1261 |
| 17988 | 1226 |
| 17989 | 1225 |
| 17990 | 1212 |
| 17991 | 1189 |
| 17992 | 1183 |
| 17993 | 1163 |
| 17994 | 1154 |
| 17995 | 1131 |
| 17996 | 1081 |
| 17997 | 1046 |
| 17998 | 1031 |
| 17999 | 1070 |
| 18000 | 1092 |
| 18001 | 1056 |
| 18002 | 1025 |
| 18003 | 988 |
| 18004 | 941 |
| 18005 | 905 |
| 18006 | 892 |
| 18007 | 869 |
| 18008 | 842 |
| 18009 | 854 |
| 18010 | 847 |
| 18011 | 826 |
| 18012 | 831 |
| 18013 | 842 |
| 18014 | 827 |
| 18015 | 821 |
| 18016 | 837 |
| 18017 | 871 |
| 18018 | 904 |
| 18019 | 952 |
| 18020 | 989 |
| 18021 | 1057 |
| 18022 | 1115 |
| 18023 | 1168 |
| 18024 | 1219 |
| 18025 | 1264 |
| 18026 | 1305 |
| 18027 | 1331 |
| 18028 | 1363 |
| 18029 | 1382 |
| 18030 | 1402 |
| 18031 | 1418 |
| 18032 | 1430 |
| 18033 | 1421 |
| 18034 | 1402 |
| 18035 | 1402 |
| 18036 | 1387 |
| 18037 | 1381 |
| 18038 | 1392 |
| 18039 | 1385 |
| 18040 | 1369 |
| 18041 | 1325 |
| 18042 | 1263 |
| 18043 | 1197 |
| 18044 | 1123 |
| 18045 | 1060 |
| 18046 | 1008 |
| 18047 | 965 |
| 18048 | 935 |
| 18049 | 897 |
| 18050 | 871 |
| 18051 | 848 |
| 18052 | 818 |
| 18053 | 794 |
| 18054 | 779 |
| 18055 | 766 |
| 18056 | 761 |
| 18057 | 754 |
| 18058 | 750 |
| 18059 | 747 |
| 18060 | 751 |
| 18061 | 744 |
| 18062 | 743 |
| 18063 | 746 |
| 18064 | 765 |
| 18065 | 771 |
| 18066 | 789 |
| 18067 | 809 |
| 18068 | 831 |
| 18069 | 822 |
| 18070 | 850 |
| 18071 | 902 |
| 18072 | 981 |
| 18073 | 1032 |
| 18074 | 1070 |
| 18075 | 1102 |
| 18076 | 1155 |
| 18077 | 1163 |
| 18078 | 1171 |
| 18079 | 1171 |
| 18080 | 1190 |
| 18081 | 1181 |
| 18082 | 1154 |
| 18083 | 1140 |
| 18084 | 1107 |
| 18085 | 1084 |
| 18086 | 1080 |
| 18087 | 1052 |
| 18088 | 1034 |
| 18089 | 993 |
| 18090 | 965 |
| 18091 | 954 |
| 18092 | 961 |
| 18093 | 1010 |
| 18094 | 1021 |
| 18095 | 1027 |
| 18096 | 990 |
| 18097 | 971 |
| 18098 | 936 |
| 18099 | 896 |
| 18100 | 863 |
| 18101 | 855 |
| 18102 | 857 |
| 18103 | 852 |
| 18104 | 855 |
| 18105 | 864 |
| 18106 | 897 |
| 18107 | 903 |
| 18108 | 909 |
| 18109 | 886 |
| 18110 | 853 |
| 18111 | 800 |
| 18112 | 733 |
| 18113 | 679 |
| 18114 | 736 |
| 18115 | 787 |
| 18116 | 885 |
| 18117 | 911 |
| 18118 | 953 |
| 18119 | 1045 |
| 18120 | 1148 |
| 18121 | 1241 |
| 18122 | 1329 |
| 18123 | 1386 |
| 18124 | 1413 |
| 18125 | 1433 |
| 18126 | 1447 |
| 18127 | 1456 |
| 18128 | 1456 |
| 18129 | 1455 |
| 18130 | 1434 |
| 18131 | 1424 |
| 18132 | 1409 |
| 18133 | 1377 |
| 18134 | 1366 |
| 18135 | 1367 |
| 18136 | 1369 |
| 18137 | 1328 |
| 18138 | 1259 |
| 18139 | 1191 |
| 18140 | 1117 |
| 18141 | 1055 |
| 18142 | 1002 |
| 18143 | 952 |
| 18144 | 917 |
| 18145 | 881 |
| 18146 | 850 |
| 18147 | 825 |
| 18148 | 809 |
| 18149 | 793 |
| 18150 | 783 |
| 18151 | 779 |
| 18152 | 765 |
| 18153 | 758 |
| 18154 | 752 |
| 18155 | 750 |
| 18156 | 751 |
| 18157 | 747 |
| 18158 | 747 |
| 18159 | 748 |
| 18160 | 769 |
| 18161 | 774 |
| 18162 | 791 |
| 18163 | 805 |
| 18164 | 819 |
| 18165 | 817 |
| 18166 | 850 |
| 18167 | 900 |
| 18168 | 975 |
| 18169 | 1015 |
| 18170 | 1048 |
| 18171 | 1081 |
| 18172 | 1137 |
| 18173 | 1149 |
| 18174 | 1159 |
| 18175 | 1162 |
| 18176 | 1166 |
| 18177 | 1147 |
| 18178 | 1117 |
| 18179 | 1074 |
| 18180 | 1021 |
| 18181 | 989 |
| 18182 | 978 |
| 18183 | 960 |
| 18184 | 914 |
| 18185 | 875 |
| 18186 | 827 |
| 18187 | 809 |
| 18188 | 793 |
| 18189 | 780 |
| 18190 | 787 |
| 18191 | 779 |
| 18192 | 757 |
| 18193 | 735 |
| 18194 | 696 |
| 18195 | 649 |
| 18196 | 650 |
| 18197 | 635 |
| 18198 | 593 |
| 18199 | 571 |
| 18200 | 631 |
| 18201 | 612 |
| 18202 | 582 |
| 18203 | 573 |
| 18204 | 634 |
| 18205 | 710 |
| 18206 | 849 |
| 18207 | 967 |
| 18208 | 1031 |
| 18209 | 1056 |
| 18210 | 1050 |
| 18211 | 1050 |
| 18212 | 1116 |
| 18213 | 1220 |
| 18214 | 1264 |
| 18215 | 1291 |
| 18216 | 1268 |
| 18217 | 1274 |
| 18218 | 1290 |
| 18219 | 1287 |
| 18220 | 1308 |
| 18221 | 1308 |
| 18222 | 1299 |
| 18223 | 1295 |
| 18224 | 1325 |
| 18225 | 1335 |
| 18226 | 1341 |
| 18227 | 1348 |
| 18228 | 1343 |
| 18229 | 1329 |
| 18230 | 1317 |
| 18231 | 1330 |
| 18232 | 1357 |
| 18233 | 1326 |
| 18234 | 1278 |
| 18235 | 1224 |
| 18236 | 1164 |
| 18237 | 1116 |
| 18238 | 1069 |
| 18239 | 1025 |
| 18240 | 995 |
| 18241 | 954 |
| 18242 | 927 |
| 18243 | 890 |
| 18244 | 865 |
| 18245 | 846 |
| 18246 | 831 |
| 18247 | 818 |
| 18248 | 803 |
| 18249 | 788 |
| 18250 | 779 |
| 18251 | 776 |
| 18252 | 774 |
| 18253 | 764 |
| 18254 | 758 |
| 18255 | 752 |
| 18256 | 757 |
| 18257 | 756 |
| 18258 | 761 |
| 18259 | 771 |
| 18260 | 765 |
| 18261 | 741 |
| 18262 | 756 |
| 18263 | 774 |
| 18264 | 818 |
| 18265 | 831 |
| 18266 | 840 |
| 18267 | 852 |
| 18268 | 894 |
| 18269 | 922 |
| 18270 | 953 |
| 18271 | 981 |
| 18272 | 1008 |
| 18273 | 1020 |
| 18274 | 1034 |
| 18275 | 1045 |
| 18276 | 1050 |
| 18277 | 1054 |
| 18278 | 1042 |
| 18279 | 1026 |
| 18280 | 1011 |
| 18281 | 984 |
| 18282 | 941 |
| 18283 | 896 |
| 18284 | 871 |
| 18285 | 883 |
| 18286 | 862 |
| 18287 | 821 |
| 18288 | 790 |
| 18289 | 784 |
| 18290 | 713 |
| 18291 | 638 |
| 18292 | 601 |
| 18293 | 552 |
| 18294 | 542 |
| 18295 | 524 |
| 18296 | 596 |
| 18297 | 727 |
| 18298 | 796 |
| 18299 | 801 |
| 18300 | 803 |
| 18301 | 693 |
| 18302 | 709 |
| 18303 | 740 |
| 18304 | 704 |
| 18305 | 746 |
| 18306 | 812 |
| 18307 | 893 |
| 18308 | 920 |
| 18309 | 985 |
| 18310 | 1069 |
| 18311 | 1164 |
| 18312 | 1177 |
| 18313 | 1207 |
| 18314 | 1239 |
| 18315 | 1277 |
| 18316 | 1300 |
| 18317 | 1300 |
| 18318 | 1300 |
| 18319 | 1306 |
| 18320 | 1312 |
| 18321 | 1319 |
| 18322 | 1311 |
| 18323 | 1254 |
| 18324 | 1303 |
| 18325 | 1278 |
| 18326 | 1284 |
| 18327 | 1317 |
| 18328 | 1294 |
| 18329 | 1263 |
| 18330 | 1226 |
| 18331 | 1192 |
| 18332 | 1143 |
| 18333 | 1093 |
| 18334 | 1046 |
| 18335 | 1014 |
| 18336 | 988 |
| 18337 | 952 |
| 18338 | 919 |
| 18339 | 884 |
| 18340 | 852 |
| 18341 | 821 |
| 18342 | 798 |
| 18343 | 781 |
| 18344 | 767 |
| 18345 | 754 |
| 18346 | 746 |
| 18347 | 738 |
| 18348 | 735 |
| 18349 | 728 |
| 18350 | 721 |
| 18351 | 714 |
| 18352 | 716 |
| 18353 | 710 |
| 18354 | 711 |
| 18355 | 716 |
| 18356 | 712 |
| 18357 | 699 |
| 18358 | 682 |
| 18359 | 684 |
| 18360 | 688 |
| 18361 | 680 |
| 18362 | 686 |
| 18363 | 680 |
| 18364 | 703 |
| 18365 | 703 |
| 18366 | 727 |
| 18367 | 735 |
| 18368 | 793 |
| 18369 | 845 |
| 18370 | 865 |
| 18371 | 858 |
| 18372 | 825 |
| 18373 | 825 |
| 18374 | 865 |
| 18375 | 886 |
| 18376 | 927 |
| 18377 | 971 |
| 18378 | 994 |
| 18379 | 951 |
| 18380 | 979 |
| 18381 | 1038 |
| 18382 | 1045 |
| 18383 | 1035 |
| 18384 | 1054 |
| 18385 | 1047 |
| 18386 | 1048 |
| 18387 | 961 |
| 18388 | 852 |
| 18389 | 817 |
| 18390 | 838 |
| 18391 | 816 |
| 18392 | 812 |
| 18393 | 773 |
| 18394 | 733 |
| 18395 | 736 |
| 18396 | 747 |
| 18397 | 800 |
| 18398 | 837 |
| 18399 | 882 |
| 18400 | 890 |
| 18401 | 877 |
| 18402 | 871 |
| 18403 | 888 |
| 18404 | 929 |
| 18405 | 989 |
| 18406 | 952 |
| 18407 | 965 |
| 18408 | 993 |
| 18409 | 1070 |
| 18410 | 1137 |
| 18411 | 1185 |
| 18412 | 1231 |
| 18413 | 1264 |
| 18414 | 1275 |
| 18415 | 1265 |
| 18416 | 1266 |
| 18417 | 1269 |
| 18418 | 1273 |
| 18419 | 1275 |
| 18420 | 1256 |
| 18421 | 1232 |
| 18422 | 1220 |
| 18423 | 1260 |
| 18424 | 1252 |
| 18425 | 1205 |
| 18426 | 1134 |
| 18427 | 1095 |
| 18428 | 1049 |
| 18429 | 1009 |
| 18430 | 956 |
| 18431 | 929 |
| 18432 | 910 |
| 18433 | 881 |
| 18434 | 849 |
| 18435 | 826 |
| 18436 | 802 |
| 18437 | 773 |
| 18438 | 756 |
| 18439 | 738 |
| 18440 | 731 |
| 18441 | 720 |
| 18442 | 715 |
| 18443 | 710 |
| 18444 | 711 |
| 18445 | 705 |
| 18446 | 701 |
| 18447 | 703 |
| 18448 | 728 |
| 18449 | 737 |
| 18450 | 756 |
| 18451 | 777 |
| 18452 | 817 |
| 18453 | 821 |
| 18454 | 837 |
| 18455 | 884 |
| 18456 | 974 |
| 18457 | 1008 |
| 18458 | 1047 |
| 18459 | 1099 |
| 18460 | 1153 |
| 18461 | 1196 |
| 18462 | 1241 |
| 18463 | 1264 |
| 18464 | 1279 |
| 18465 | 1295 |
| 18466 | 1299 |
| 18467 | 1286 |
| 18468 | 1266 |
| 18469 | 1263 |
| 18470 | 1268 |
| 18471 | 1229 |
| 18472 | 1252 |
| 18473 | 1246 |
| 18474 | 1246 |
| 18475 | 1232 |
| 18476 | 1279 |
| 18477 | 1218 |
| 18478 | 1181 |
| 18479 | 1159 |
| 18480 | 1042 |
| 18481 | 981 |
| 18482 | 923 |
| 18483 | 925 |
| 18484 | 882 |
| 18485 | 835 |
| 18486 | 795 |
| 18487 | 735 |
| 18488 | 798 |
| 18489 | 793 |
| 18490 | 796 |
| 18491 | 801 |
| 18492 | 817 |
| 18493 | 870 |
| 18494 | 948 |
| 18495 | 980 |
| 18496 | 919 |
| 18497 | 909 |
| 18498 | 955 |
| 18499 | 1000 |
| 18500 | 1065 |
| 18501 | 1126 |
| 18502 | 1173 |
| 18503 | 1231 |
| 18504 | 1298 |
| 18505 | 1367 |
| 18506 | 1429 |
| 18507 | 1464 |
| 18508 | 1454 |
| 18509 | 1425 |
| 18510 | 1418 |
| 18511 | 1417 |
| 18512 | 1410 |
| 18513 | 1377 |
| 18514 | 1374 |
| 18515 | 1383 |
| 18516 | 1370 |
| 18517 | 1350 |
| 18518 | 1329 |
| 18519 | 1352 |
| 18520 | 1348 |
| 18521 | 1296 |
| 18522 | 1226 |
| 18523 | 1154 |
| 18524 | 1081 |
| 18525 | 1020 |
| 18526 | 965 |
| 18527 | 918 |
| 18528 | 886 |
| 18529 | 856 |
| 18530 | 828 |
| 18531 | 806 |
| 18532 | 789 |
| 18533 | 772 |
| 18534 | 760 |
| 18535 | 756 |
| 18536 | 746 |
| 18537 | 742 |
| 18538 | 750 |
| 18539 | 747 |
| 18540 | 754 |
| 18541 | 753 |
| 18542 | 758 |
| 18543 | 760 |
| 18544 | 776 |
| 18545 | 779 |
| 18546 | 791 |
| 18547 | 810 |
| 18548 | 852 |
| 18549 | 842 |
| 18550 | 859 |
| 18551 | 914 |
| 18552 | 995 |
| 18553 | 1039 |
| 18554 | 1075 |
| 18555 | 1109 |
| 18556 | 1177 |
| 18557 | 1225 |
| 18558 | 1252 |
| 18559 | 1267 |
| 18560 | 1279 |
| 18561 | 1256 |
| 18562 | 1235 |
| 18563 | 1213 |
| 18564 | 1191 |
| 18565 | 1170 |
| 18566 | 1151 |
| 18567 | 1131 |
| 18568 | 1137 |
| 18569 | 1119 |
| 18570 | 1080 |
| 18571 | 1080 |
| 18572 | 1069 |
| 18573 | 1053 |
| 18574 | 1089 |
| 18575 | 1081 |
| 18576 | 1027 |
| 18577 | 969 |
| 18578 | 907 |
| 18579 | 922 |
| 18580 | 984 |
| 18581 | 993 |
| 18582 | 954 |
| 18583 | 939 |
| 18584 | 906 |
| 18585 | 866 |
| 18586 | 859 |
| 18587 | 905 |
| 18588 | 891 |
| 18589 | 937 |
| 18590 | 944 |
| 18591 | 912 |
| 18592 | 956 |
| 18593 | 985 |
| 18594 | 1044 |
| 18595 | 1054 |
| 18596 | 1044 |
| 18597 | 1105 |
| 18598 | 1158 |
| 18599 | 1233 |
| 18600 | 1258 |
| 18601 | 1302 |
| 18602 | 1344 |
| 18603 | 1378 |
| 18604 | 1384 |
| 18605 | 1402 |
| 18606 | 1425 |
| 18607 | 1429 |
| 18608 | 1424 |
| 18609 | 1424 |
| 18610 | 1420 |
| 18611 | 1413 |
| 18612 | 1401 |
| 18613 | 1390 |
| 18614 | 1387 |
| 18615 | 1391 |
| 18616 | 1356 |
| 18617 | 1296 |
| 18618 | 1242 |
| 18619 | 1206 |
| 18620 | 1135 |
| 18621 | 1077 |
| 18622 | 1025 |
| 18623 | 994 |
| 18624 | 964 |
| 18625 | 920 |
| 18626 | 876 |
| 18627 | 842 |
| 18628 | 815 |
| 18629 | 791 |
| 18630 | 776 |
| 18631 | 765 |
| 18632 | 754 |
| 18633 | 742 |
| 18634 | 739 |
| 18635 | 737 |
| 18636 | 738 |
| 18637 | 731 |
| 18638 | 733 |
| 18639 | 736 |
| 18640 | 752 |
| 18641 | 758 |
| 18642 | 773 |
| 18643 | 798 |
| 18644 | 835 |
| 18645 | 835 |
| 18646 | 860 |
| 18647 | 906 |
| 18648 | 991 |
| 18649 | 1042 |
| 18650 | 1088 |
| 18651 | 1123 |
| 18652 | 1172 |
| 18653 | 1210 |
| 18654 | 1237 |
| 18655 | 1257 |
| 18656 | 1274 |
| 18657 | 1294 |
| 18658 | 1312 |
| 18659 | 1302 |
| 18660 | 1270 |
| 18661 | 1273 |
| 18662 | 1275 |
| 18663 | 1260 |
| 18664 | 1262 |
| 18665 | 1236 |
| 18666 | 1216 |
| 18667 | 1204 |
| 18668 | 1162 |
| 18669 | 1101 |
| 18670 | 1088 |
| 18671 | 1124 |
| 18672 | 1147 |
| 18673 | 1107 |
| 18674 | 1066 |
| 18675 | 1052 |
| 18676 | 1009 |
| 18677 | 1011 |
| 18678 | 1015 |
| 18679 | 998 |
| 18680 | 931 |
| 18681 | 967 |
| 18682 | 975 |
| 18683 | 931 |
| 18684 | 896 |
| 18685 | 886 |
| 18686 | 881 |
| 18687 | 885 |
| 18688 | 878 |
| 18689 | 904 |
| 18690 | 944 |
| 18691 | 988 |
| 18692 | 1024 |
| 18693 | 1090 |
| 18694 | 1151 |
| 18695 | 1203 |
| 18696 | 1253 |
| 18697 | 1307 |
| 18698 | 1348 |
| 18699 | 1369 |
| 18700 | 1383 |
| 18701 | 1384 |
| 18702 | 1404 |
| 18703 | 1424 |
| 18704 | 1431 |
| 18705 | 1410 |
| 18706 | 1397 |
| 18707 | 1404 |
| 18708 | 1384 |
| 18709 | 1379 |
| 18710 | 1387 |
| 18711 | 1410 |
| 18712 | 1382 |
| 18713 | 1332 |
| 18714 | 1270 |
| 18715 | 1206 |
| 18716 | 1135 |
| 18717 | 1073 |
| 18718 | 1021 |
| 18719 | 980 |
| 18720 | 948 |
| 18721 | 914 |
| 18722 | 885 |
| 18723 | 858 |
| 18724 | 826 |
| 18725 | 799 |
| 18726 | 784 |
| 18727 | 771 |
| 18728 | 766 |
| 18729 | 757 |
| 18730 | 754 |
| 18731 | 750 |
| 18732 | 756 |
| 18733 | 748 |
| 18734 | 747 |
| 18735 | 751 |
| 18736 | 770 |
| 18737 | 776 |
| 18738 | 794 |
| 18739 | 817 |
| 18740 | 850 |
| 18741 | 834 |
| 18742 | 852 |
| 18743 | 882 |
| 18744 | 962 |
| 18745 | 1017 |
| 18746 | 1054 |
| 18747 | 1096 |
| 18748 | 1151 |
| 18749 | 1168 |
| 18750 | 1184 |
| 18751 | 1198 |
| 18752 | 1206 |
| 18753 | 1193 |
| 18754 | 1177 |
| 18755 | 1181 |
| 18756 | 1163 |
| 18757 | 1150 |
| 18758 | 1139 |
| 18759 | 1086 |
| 18760 | 1092 |
| 18761 | 1056 |
| 18762 | 998 |
| 18763 | 993 |
| 18764 | 998 |
| 18765 | 1048 |
| 18766 | 1056 |
| 18767 | 1052 |
| 18768 | 1043 |
| 18769 | 1035 |
| 18770 | 1019 |
| 18771 | 1001 |
| 18772 | 962 |
| 18773 | 952 |
| 18774 | 951 |
| 18775 | 962 |
| 18776 | 990 |
| 18777 | 1018 |
| 18778 | 1049 |
| 18779 | 1039 |
| 18780 | 1084 |
| 18781 | 1081 |
| 18782 | 1077 |
| 18783 | 1032 |
| 18784 | 963 |
| 18785 | 874 |
| 18786 | 896 |
| 18787 | 910 |
| 18788 | 1022 |
| 18789 | 1046 |
| 18790 | 1098 |
| 18791 | 1161 |
| 18792 | 1258 |
| 18793 | 1345 |
| 18794 | 1402 |
| 18795 | 1390 |
| 18796 | 1402 |
| 18797 | 1424 |
| 18798 | 1449 |
| 18799 | 1466 |
| 18800 | 1463 |
| 18801 | 1447 |
| 18802 | 1416 |
| 18803 | 1403 |
| 18804 | 1364 |
| 18805 | 1333 |
| 18806 | 1323 |
| 18807 | 1367 |
| 18808 | 1360 |
| 18809 | 1308 |
| 18810 | 1240 |
| 18811 | 1176 |
| 18812 | 1109 |
| 18813 | 1050 |
| 18814 | 996 |
| 18815 | 951 |
| 18816 | 917 |
| 18817 | 884 |
| 18818 | 853 |
| 18819 | 829 |
| 18820 | 813 |
| 18821 | 796 |
| 18822 | 784 |
| 18823 | 779 |
| 18824 | 768 |
| 18825 | 759 |
| 18826 | 751 |
| 18827 | 748 |
| 18828 | 746 |
| 18829 | 743 |
| 18830 | 747 |
| 18831 | 749 |
| 18832 | 770 |
| 18833 | 776 |
| 18834 | 792 |
| 18835 | 812 |
| 18836 | 837 |
| 18837 | 833 |
| 18838 | 855 |
| 18839 | 905 |
| 18840 | 974 |
| 18841 | 1022 |
| 18842 | 1059 |
| 18843 | 1088 |
| 18844 | 1149 |
| 18845 | 1173 |
| 18846 | 1186 |
| 18847 | 1183 |
| 18848 | 1199 |
| 18849 | 1183 |
| 18850 | 1149 |
| 18851 | 1105 |
| 18852 | 1052 |
| 18853 | 1019 |
| 18854 | 993 |
| 18855 | 963 |
| 18856 | 935 |
| 18857 | 897 |
| 18858 | 844 |
| 18859 | 838 |
| 18860 | 853 |
| 18861 | 830 |
| 18862 | 832 |
| 18863 | 817 |
| 18864 | 789 |
| 18865 | 772 |
| 18866 | 732 |
| 18867 | 688 |
| 18868 | 659 |
| 18869 | 630 |
| 18870 | 595 |
| 18871 | 584 |
| 18872 | 616 |
| 18873 | 601 |
| 18874 | 603 |
| 18875 | 600 |
| 18876 | 653 |
| 18877 | 706 |
| 18878 | 798 |
| 18879 | 854 |
| 18880 | 898 |
| 18881 | 955 |
| 18882 | 978 |
| 18883 | 1030 |
| 18884 | 1108 |
| 18885 | 1192 |
| 18886 | 1233 |
| 18887 | 1278 |
| 18888 | 1284 |
| 18889 | 1305 |
| 18890 | 1315 |
| 18891 | 1327 |
| 18892 | 1343 |
| 18893 | 1346 |
| 18894 | 1357 |
| 18895 | 1361 |
| 18896 | 1364 |
| 18897 | 1351 |
| 18898 | 1347 |
| 18899 | 1349 |
| 18900 | 1336 |
| 18901 | 1321 |
| 18902 | 1304 |
| 18903 | 1346 |
| 18904 | 1357 |
| 18905 | 1323 |
| 18906 | 1271 |
| 18907 | 1216 |
| 18908 | 1153 |
| 18909 | 1103 |
| 18910 | 1053 |
| 18911 | 1008 |
| 18912 | 980 |
| 18913 | 943 |
| 18914 | 916 |
| 18915 | 882 |
| 18916 | 861 |
| 18917 | 844 |
| 18918 | 828 |
| 18919 | 814 |
| 18920 | 803 |
| 18921 | 788 |
| 18922 | 781 |
| 18923 | 780 |
| 18924 | 780 |
| 18925 | 772 |
| 18926 | 766 |
| 18927 | 762 |
| 18928 | 772 |
| 18929 | 773 |
| 18930 | 776 |
| 18931 | 783 |
| 18932 | 790 |
| 18933 | 763 |
| 18934 | 766 |
| 18935 | 778 |
| 18936 | 814 |
| 18937 | 829 |
| 18938 | 830 |
| 18939 | 839 |
| 18940 | 876 |
| 18941 | 903 |
| 18942 | 920 |
| 18943 | 933 |
| 18944 | 940 |
| 18945 | 936 |
| 18946 | 942 |
| 18947 | 926 |
| 18948 | 920 |
| 18949 | 906 |
| 18950 | 886 |
| 18951 | 863 |
| 18952 | 848 |
| 18953 | 813 |
| 18954 | 776 |
| 18955 | 746 |
| 18956 | 735 |
| 18957 | 750 |
| 18958 | 771 |
| 18959 | 748 |
| 18960 | 703 |
| 18961 | 671 |
| 18962 | 622 |
| 18963 | 584 |
| 18964 | 555 |
| 18965 | 544 |
| 18966 | 540 |
| 18967 | 523 |
| 18968 | 560 |
| 18969 | 660 |
| 18970 | 684 |
| 18971 | 700 |
| 18972 | 699 |
| 18973 | 613 |
| 18974 | 665 |
| 18975 | 740 |
| 18976 | 676 |
| 18977 | 725 |
| 18978 | 797 |
| 18979 | 852 |
| 18980 | 864 |
| 18981 | 942 |
| 18982 | 1045 |
| 18983 | 1128 |
| 18984 | 1126 |
| 18985 | 1148 |
| 18986 | 1185 |
| 18987 | 1225 |
| 18988 | 1238 |
| 18989 | 1237 |
| 18990 | 1248 |
| 18991 | 1261 |
| 18992 | 1269 |
| 18993 | 1282 |
| 18994 | 1276 |
| 18995 | 1221 |
| 18996 | 1273 |
| 18997 | 1253 |
| 18998 | 1268 |
| 18999 | 1306 |
| 19000 | 1286 |
| 19001 | 1256 |
| 19002 | 1216 |
| 19003 | 1185 |
| 19004 | 1139 |
| 19005 | 1090 |
| 19006 | 1043 |
| 19007 | 1004 |
| 19008 | 974 |
| 19009 | 935 |
| 19010 | 901 |
| 19011 | 871 |
| 19012 | 846 |
| 19013 | 819 |
| 19014 | 801 |
| 19015 | 784 |
| 19016 | 770 |
| 19017 | 756 |
| 19018 | 743 |
| 19019 | 738 |
| 19020 | 732 |
| 19021 | 730 |
| 19022 | 721 |
| 19023 | 719 |
| 19024 | 720 |
| 19025 | 714 |
| 19026 | 716 |
| 19027 | 718 |
| 19028 | 728 |
| 19029 | 714 |
| 19030 | 684 |
| 19031 | 687 |
| 19032 | 691 |
| 19033 | 686 |
| 19034 | 690 |
| 19035 | 692 |
| 19036 | 708 |
| 19037 | 711 |
| 19038 | 734 |
| 19039 | 759 |
| 19040 | 795 |
| 19041 | 847 |
| 19042 | 875 |
| 19043 | 868 |
| 19044 | 837 |
| 19045 | 821 |
| 19046 | 851 |
| 19047 | 883 |
| 19048 | 940 |
| 19049 | 971 |
| 19050 | 957 |
| 19051 | 918 |
| 19052 | 964 |
| 19053 | 1018 |
| 19054 | 1040 |
| 19055 | 1026 |
| 19056 | 1016 |
| 19057 | 999 |
| 19058 | 979 |
| 19059 | 908 |
| 19060 | 803 |
| 19061 | 781 |
| 19062 | 781 |
| 19063 | 765 |
| 19064 | 742 |
| 19065 | 708 |
| 19066 | 654 |
| 19067 | 650 |
| 19068 | 659 |
| 19069 | 736 |
| 19070 | 713 |
| 19071 | 725 |
| 19072 | 758 |
| 19073 | 764 |
| 19074 | 789 |
| 19075 | 778 |
| 19076 | 859 |
| 19077 | 918 |
| 19078 | 939 |
| 19079 | 972 |
| 19080 | 985 |
| 19081 | 1057 |
| 19082 | 1127 |
| 19083 | 1186 |
| 19084 | 1230 |
| 19085 | 1267 |
| 19086 | 1276 |
| 19087 | 1264 |
| 19088 | 1261 |
| 19089 | 1266 |
| 19090 | 1270 |
| 19091 | 1264 |
| 19092 | 1252 |
| 19093 | 1234 |
| 19094 | 1234 |
| 19095 | 1281 |
| 19096 | 1246 |
| 19097 | 1199 |
| 19098 | 1147 |
| 19099 | 1106 |
| 19100 | 1059 |
| 19101 | 1016 |
| 19102 | 967 |
| 19103 | 938 |
| 19104 | 918 |
| 19105 | 893 |
| 19106 | 860 |
| 19107 | 837 |
| 19108 | 811 |
| 19109 | 786 |
| 19110 | 764 |
| 19111 | 746 |
| 19112 | 737 |
| 19113 | 724 |
| 19114 | 718 |
| 19115 | 715 |
| 19116 | 715 |
| 19117 | 709 |
| 19118 | 706 |
| 19119 | 708 |
| 19120 | 736 |
| 19121 | 743 |
| 19122 | 761 |
| 19123 | 780 |
| 19124 | 824 |
| 19125 | 837 |
| 19126 | 844 |
| 19127 | 879 |
| 19128 | 968 |
| 19129 | 1006 |
| 19130 | 1051 |
| 19131 | 1084 |
| 19132 | 1136 |
| 19133 | 1177 |
| 19134 | 1215 |
| 19135 | 1237 |
| 19136 | 1250 |
| 19137 | 1247 |
| 19138 | 1239 |
| 19139 | 1219 |
| 19140 | 1213 |
| 19141 | 1235 |
| 19142 | 1243 |
| 19143 | 1217 |
| 19144 | 1209 |
| 19145 | 1171 |
| 19146 | 1154 |
| 19147 | 1125 |
| 19148 | 1135 |
| 19149 | 1044 |
| 19150 | 1045 |
| 19151 | 1100 |
| 19152 | 988 |
| 19153 | 926 |
| 19154 | 891 |
| 19155 | 872 |
| 19156 | 872 |
| 19157 | 869 |
| 19158 | 870 |
| 19159 | 839 |
| 19160 | 906 |
| 19161 | 850 |
| 19162 | 805 |
| 19163 | 845 |
| 19164 | 848 |
| 19165 | 838 |
| 19166 | 874 |
| 19167 | 892 |
| 19168 | 858 |
| 19169 | 875 |
| 19170 | 914 |
| 19171 | 928 |
| 19172 | 997 |
| 19173 | 1076 |
| 19174 | 1141 |
| 19175 | 1210 |
| 19176 | 1247 |
| 19177 | 1320 |
| 19178 | 1363 |
| 19179 | 1402 |
| 19180 | 1435 |
| 19181 | 1430 |
| 19182 | 1427 |
| 19183 | 1440 |
| 19184 | 1431 |
| 19185 | 1400 |
| 19186 | 1375 |
| 19187 | 1375 |
| 19188 | 1377 |
| 19189 | 1356 |
| 19190 | 1349 |
| 19191 | 1374 |
| 19192 | 1352 |
| 19193 | 1297 |
| 19194 | 1228 |
| 19195 | 1161 |
| 19196 | 1089 |
| 19197 | 1032 |
| 19198 | 980 |
| 19199 | 935 |
| 19200 | 904 |
| 19201 | 872 |
| 19202 | 847 |
| 19203 | 828 |
| 19204 | 810 |
| 19205 | 794 |
| 19206 | 782 |
| 19207 | 775 |
| 19208 | 766 |
| 19209 | 753 |
| 19210 | 762 |
| 19211 | 760 |
| 19212 | 753 |
| 19213 | 741 |
| 19214 | 746 |
| 19215 | 757 |
| 19216 | 777 |
| 19217 | 772 |
| 19218 | 784 |
| 19219 | 805 |
| 19220 | 841 |
| 19221 | 845 |
| 19222 | 857 |
| 19223 | 901 |
| 19224 | 975 |
| 19225 | 1009 |
| 19226 | 1048 |
| 19227 | 1070 |
| 19228 | 1120 |
| 19229 | 1150 |
| 19230 | 1165 |
| 19231 | 1167 |
| 19232 | 1159 |
| 19233 | 1169 |
| 19234 | 1142 |
| 19235 | 1114 |
| 19236 | 1084 |
| 19237 | 1033 |
| 19238 | 986 |
| 19239 | 981 |
| 19240 | 983 |
| 19241 | 997 |
| 19242 | 1024 |
| 19243 | 1051 |
| 19244 | 1044 |
| 19245 | 1012 |
| 19246 | 1039 |
| 19247 | 1027 |
| 19248 | 977 |
| 19249 | 933 |
| 19250 | 877 |
| 19251 | 868 |
| 19252 | 862 |
| 19253 | 877 |
| 19254 | 873 |
| 19255 | 869 |
| 19256 | 870 |
| 19257 | 799 |
| 19258 | 714 |
| 19259 | 669 |
| 19260 | 680 |
| 19261 | 793 |
| 19262 | 835 |
| 19263 | 832 |
| 19264 | 898 |
| 19265 | 985 |
| 19266 | 1060 |
| 19267 | 1052 |
| 19268 | 1020 |
| 19269 | 1078 |
| 19270 | 1123 |
| 19271 | 1170 |
| 19272 | 1173 |
| 19273 | 1201 |
| 19274 | 1242 |
| 19275 | 1279 |
| 19276 | 1285 |
| 19277 | 1328 |
| 19278 | 1373 |
| 19279 | 1388 |
| 19280 | 1391 |
| 19281 | 1392 |
| 19282 | 1397 |
| 19283 | 1402 |
| 19284 | 1393 |
| 19285 | 1383 |
| 19286 | 1384 |
| 19287 | 1394 |
| 19288 | 1361 |
| 19289 | 1298 |
| 19290 | 1236 |
| 19291 | 1171 |
| 19292 | 1100 |
| 19293 | 1048 |
| 19294 | 993 |
| 19295 | 954 |
| 19296 | 922 |
| 19297 | 888 |
| 19298 | 857 |
| 19299 | 833 |
| 19300 | 816 |
| 19301 | 798 |
| 19302 | 782 |
| 19303 | 769 |
| 19304 | 764 |
| 19305 | 755 |
| 19306 | 751 |
| 19307 | 752 |
| 19308 | 758 |
| 19309 | 752 |
| 19310 | 755 |
| 19311 | 760 |
| 19312 | 776 |
| 19313 | 781 |
| 19314 | 795 |
| 19315 | 819 |
| 19316 | 857 |
| 19317 | 860 |
| 19318 | 878 |
| 19319 | 917 |
| 19320 | 995 |
| 19321 | 1049 |
| 19322 | 1093 |
| 19323 | 1125 |
| 19324 | 1175 |
| 19325 | 1221 |
| 19326 | 1251 |
| 19327 | 1269 |
| 19328 | 1278 |
| 19329 | 1293 |
| 19330 | 1309 |
| 19331 | 1307 |
| 19332 | 1275 |
| 19333 | 1269 |
| 19334 | 1278 |
| 19335 | 1253 |
| 19336 | 1241 |
| 19337 | 1209 |
| 19338 | 1174 |
| 19339 | 1157 |
| 19340 | 1123 |
| 19341 | 1068 |
| 19342 | 1058 |
| 19343 | 1076 |
| 19344 | 1078 |
| 19345 | 1039 |
| 19346 | 1013 |
| 19347 | 1012 |
| 19348 | 982 |
| 19349 | 999 |
| 19350 | 998 |
| 19351 | 963 |
| 19352 | 891 |
| 19353 | 922 |
| 19354 | 921 |
| 19355 | 880 |
| 19356 | 838 |
| 19357 | 820 |
| 19358 | 859 |
| 19359 | 872 |
| 19360 | 868 |
| 19361 | 908 |
| 19362 | 950 |
| 19363 | 993 |
| 19364 | 1013 |
| 19365 | 1054 |
| 19366 | 1106 |
| 19367 | 1167 |
| 19368 | 1213 |
| 19369 | 1269 |
| 19370 | 1312 |
| 19371 | 1332 |
| 19372 | 1338 |
| 19373 | 1327 |
| 19374 | 1346 |
| 19375 | 1378 |
| 19376 | 1394 |
| 19377 | 1378 |
| 19378 | 1371 |
| 19379 | 1385 |
| 19380 | 1362 |
| 19381 | 1362 |
| 19382 | 1365 |
| 19383 | 1389 |
| 19384 | 1361 |
| 19385 | 1310 |
| 19386 | 1243 |
| 19387 | 1172 |
| 19388 | 1103 |
| 19389 | 1046 |
| 19390 | 994 |
| 19391 | 951 |
| 19392 | 914 |
| 19393 | 884 |
| 19394 | 854 |
| 19395 | 829 |
| 19396 | 809 |
| 19397 | 788 |
| 19398 | 778 |
| 19399 | 770 |
| 19400 | 763 |
| 19401 | 753 |
| 19402 | 753 |
| 19403 | 753 |
| 19404 | 756 |
| 19405 | 751 |
| 19406 | 750 |
| 19407 | 752 |
| 19408 | 772 |
| 19409 | 777 |
| 19410 | 793 |
| 19411 | 814 |
| 19412 | 846 |
| 19413 | 844 |
| 19414 | 848 |
| 19415 | 871 |
| 19416 | 945 |
| 19417 | 989 |
| 19418 | 1016 |
| 19419 | 1045 |
| 19420 | 1096 |
| 19421 | 1127 |
| 19422 | 1137 |
| 19423 | 1148 |
| 19424 | 1136 |
| 19425 | 1117 |
| 19426 | 1090 |
| 19427 | 1075 |
| 19428 | 1037 |
| 19429 | 1001 |
| 19430 | 964 |
| 19431 | 919 |
| 19432 | 911 |
| 19433 | 875 |
| 19434 | 810 |
| 19435 | 803 |
| 19436 | 789 |
| 19437 | 785 |
| 19438 | 786 |
| 19439 | 788 |
| 19440 | 789 |
| 19441 | 779 |
| 19442 | 728 |
| 19443 | 728 |
| 19444 | 712 |
| 19445 | 705 |
| 19446 | 679 |
| 19447 | 689 |
| 19448 | 738 |
| 19449 | 761 |
| 19450 | 779 |
| 19451 | 786 |
| 19452 | 833 |
| 19453 | 835 |
| 19454 | 867 |
| 19455 | 858 |
| 19456 | 850 |
| 19457 | 851 |
| 19458 | 854 |
| 19459 | 852 |
| 19460 | 936 |
| 19461 | 995 |
| 19462 | 1064 |
| 19463 | 1104 |
| 19464 | 1151 |
| 19465 | 1208 |
| 19466 | 1239 |
| 19467 | 1220 |
| 19468 | 1239 |
| 19469 | 1272 |
| 19470 | 1320 |
| 19471 | 1362 |
| 19472 | 1370 |
| 19473 | 1362 |
| 19474 | 1351 |
| 19475 | 1354 |
| 19476 | 1326 |
| 19477 | 1315 |
| 19478 | 1326 |
| 19479 | 1367 |
| 19480 | 1357 |
| 19481 | 1306 |
| 19482 | 1241 |
| 19483 | 1182 |
| 19484 | 1118 |
| 19485 | 1056 |
| 19486 | 1005 |
| 19487 | 959 |
| 19488 | 925 |
| 19489 | 897 |
| 19490 | 869 |
| 19491 | 846 |
| 19492 | 826 |
| 19493 | 805 |
| 19494 | 789 |
| 19495 | 783 |
| 19496 | 775 |
| 19497 | 766 |
| 19498 | 760 |
| 19499 | 756 |
| 19500 | 752 |
| 19501 | 749 |
| 19502 | 753 |
| 19503 | 756 |
| 19504 | 774 |
| 19505 | 780 |
| 19506 | 795 |
| 19507 | 812 |
| 19508 | 846 |
| 19509 | 851 |
| 19510 | 858 |
| 19511 | 896 |
| 19512 | 964 |
| 19513 | 1009 |
| 19514 | 1042 |
| 19515 | 1067 |
| 19516 | 1113 |
| 19517 | 1138 |
| 19518 | 1152 |
| 19519 | 1143 |
| 19520 | 1149 |
| 19521 | 1130 |
| 19522 | 1103 |
| 19523 | 1067 |
| 19524 | 1017 |
| 19525 | 977 |
| 19526 | 956 |
| 19527 | 917 |
| 19528 | 895 |
| 19529 | 857 |
| 19530 | 812 |
| 19531 | 811 |
| 19532 | 838 |
| 19533 | 833 |
| 19534 | 826 |
| 19535 | 809 |
| 19536 | 761 |
| 19537 | 758 |
| 19538 | 707 |
| 19539 | 673 |
| 19540 | 678 |
| 19541 | 627 |
| 19542 | 633 |
| 19543 | 605 |
| 19544 | 593 |
| 19545 | 581 |
| 19546 | 594 |
| 19547 | 605 |
| 19548 | 628 |
| 19549 | 653 |
| 19550 | 680 |
| 19551 | 711 |
| 19552 | 719 |
| 19553 | 770 |
| 19554 | 799 |
| 19555 | 863 |
| 19556 | 946 |
| 19557 | 1035 |
| 19558 | 1096 |
| 19559 | 1151 |
| 19560 | 1166 |
| 19561 | 1215 |
| 19562 | 1253 |
| 19563 | 1288 |
| 19564 | 1306 |
| 19565 | 1298 |
| 19566 | 1301 |
| 19567 | 1312 |
| 19568 | 1316 |
| 19569 | 1308 |
| 19570 | 1318 |
| 19571 | 1329 |
| 19572 | 1315 |
| 19573 | 1307 |
| 19574 | 1317 |
| 19575 | 1357 |
| 19576 | 1344 |
| 19577 | 1308 |
| 19578 | 1262 |
| 19579 | 1210 |
| 19580 | 1150 |
| 19581 | 1101 |
| 19582 | 1052 |
| 19583 | 1007 |
| 19584 | 977 |
| 19585 | 941 |
| 19586 | 908 |
| 19587 | 882 |
| 19588 | 863 |
| 19589 | 842 |
| 19590 | 827 |
| 19591 | 813 |
| 19592 | 805 |
| 19593 | 792 |
| 19594 | 785 |
| 19595 | 783 |
| 19596 | 782 |
| 19597 | 773 |
| 19598 | 767 |
| 19599 | 764 |
| 19600 | 774 |
| 19601 | 773 |
| 19602 | 777 |
| 19603 | 781 |
| 19604 | 795 |
| 19605 | 776 |
| 19606 | 770 |
| 19607 | 772 |
| 19608 | 810 |
| 19609 | 828 |
| 19610 | 830 |
| 19611 | 838 |
| 19612 | 862 |
| 19613 | 879 |
| 19614 | 893 |
| 19615 | 910 |
| 19616 | 928 |
| 19617 | 940 |
| 19618 | 933 |
| 19619 | 924 |
| 19620 | 917 |
| 19621 | 898 |
| 19622 | 893 |
| 19623 | 859 |
| 19624 | 849 |
| 19625 | 814 |
| 19626 | 781 |
| 19627 | 764 |
| 19628 | 758 |
| 19629 | 759 |
| 19630 | 753 |
| 19631 | 783 |
| 19632 | 755 |
| 19633 | 738 |
| 19634 | 739 |
| 19635 | 698 |
| 19636 | 689 |
| 19637 | 699 |
| 19638 | 682 |
| 19639 | 685 |
| 19640 | 682 |
| 19641 | 669 |
| 19642 | 657 |
| 19643 | 721 |
| 19644 | 722 |
| 19645 | 742 |
| 19646 | 747 |
| 19647 | 777 |
| 19648 | 767 |
| 19649 | 818 |
| 19650 | 877 |
| 19651 | 922 |
| 19652 | 976 |
| 19653 | 996 |
| 19654 | 1045 |
| 19655 | 1066 |
| 19656 | 1123 |
| 19657 | 1165 |
| 19658 | 1218 |
| 19659 | 1220 |
| 19660 | 1205 |
| 19661 | 1184 |
| 19662 | 1192 |
| 19663 | 1225 |
| 19664 | 1243 |
| 19665 | 1252 |
| 19666 | 1248 |
| 19667 | 1198 |
| 19668 | 1252 |
| 19669 | 1233 |
| 19670 | 1268 |
| 19671 | 1294 |
| 19672 | 1270 |
| 19673 | 1241 |
| 19674 | 1203 |
| 19675 | 1166 |
| 19676 | 1120 |
| 19677 | 1073 |
| 19678 | 1025 |
| 19679 | 987 |
| 19680 | 961 |
| 19681 | 927 |
| 19682 | 898 |
| 19683 | 874 |
| 19684 | 850 |
| 19685 | 823 |
| 19686 | 810 |
| 19687 | 795 |
| 19688 | 780 |
| 19689 | 766 |
| 19690 | 755 |
| 19691 | 753 |
| 19692 | 744 |
| 19693 | 740 |
| 19694 | 734 |
| 19695 | 735 |
| 19696 | 734 |
| 19697 | 730 |
| 19698 | 731 |
| 19699 | 731 |
| 19700 | 741 |
| 19701 | 730 |
| 19702 | 710 |
| 19703 | 696 |
| 19704 | 696 |
| 19705 | 694 |
| 19706 | 698 |
| 19707 | 702 |
| 19708 | 709 |
| 19709 | 706 |
| 19710 | 720 |
| 19711 | 727 |
| 19712 | 735 |
| 19713 | 778 |
| 19714 | 805 |
| 19715 | 809 |
| 19716 | 789 |
| 19717 | 774 |
| 19718 | 785 |
| 19719 | 800 |
| 19720 | 821 |
| 19721 | 832 |
| 19722 | 814 |
| 19723 | 798 |
| 19724 | 814 |
| 19725 | 829 |
| 19726 | 817 |
| 19727 | 821 |
| 19728 | 866 |
| 19729 | 869 |
| 19730 | 824 |
| 19731 | 791 |
| 19732 | 688 |
| 19733 | 682 |
| 19734 | 696 |
| 19735 | 711 |
| 19736 | 716 |
| 19737 | 742 |
| 19738 | 744 |
| 19739 | 771 |
| 19740 | 782 |
| 19741 | 829 |
| 19742 | 832 |
| 19743 | 819 |
| 19744 | 824 |
| 19745 | 799 |
| 19746 | 776 |
| 19747 | 764 |
| 19748 | 842 |
| 19749 | 881 |
| 19750 | 899 |
| 19751 | 930 |
| 19752 | 991 |
| 19753 | 1045 |
| 19754 | 1085 |
| 19755 | 1125 |
| 19756 | 1155 |
| 19757 | 1197 |
| 19758 | 1224 |
| 19759 | 1249 |
| 19760 | 1256 |
| 19761 | 1254 |
| 19762 | 1257 |
| 19763 | 1257 |
| 19764 | 1266 |
| 19765 | 1274 |
| 19766 | 1294 |
| 19767 | 1310 |
| 19768 | 1266 |
| 19769 | 1219 |
| 19770 | 1157 |
| 19771 | 1102 |
| 19772 | 1046 |
| 19773 | 993 |
| 19774 | 937 |
| 19775 | 899 |
| 19776 | 877 |
| 19777 | 844 |
| 19778 | 818 |
| 19779 | 798 |
| 19780 | 782 |
| 19781 | 768 |
| 19782 | 752 |
| 19783 | 744 |
| 19784 | 737 |
| 19785 | 727 |
| 19786 | 726 |
| 19787 | 723 |
| 19788 | 723 |
| 19789 | 718 |
| 19790 | 717 |
| 19791 | 720 |
| 19792 | 745 |
| 19793 | 752 |
| 19794 | 768 |
| 19795 | 789 |
| 19796 | 834 |
| 19797 | 848 |
| 19798 | 858 |
| 19799 | 885 |
| 19800 | 973 |
| 19801 | 1018 |
| 19802 | 1059 |
| 19803 | 1090 |
| 19804 | 1143 |
| 19805 | 1177 |
| 19806 | 1209 |
| 19807 | 1235 |
| 19808 | 1260 |
| 19809 | 1253 |
| 19810 | 1219 |
| 19811 | 1194 |
| 19812 | 1188 |
| 19813 | 1205 |
| 19814 | 1219 |
| 19815 | 1235 |
| 19816 | 1254 |
| 19817 | 1198 |
| 19818 | 1124 |
| 19819 | 1094 |
| 19820 | 1048 |
| 19821 | 966 |
| 19822 | 985 |
| 19823 | 997 |
| 19824 | 953 |
| 19825 | 903 |
| 19826 | 845 |
| 19827 | 862 |
| 19828 | 899 |
| 19829 | 893 |
| 19830 | 912 |
| 19831 | 916 |
| 19832 | 972 |
| 19833 | 928 |
| 19834 | 881 |
| 19835 | 918 |
| 19836 | 929 |
| 19837 | 921 |
| 19838 | 912 |
| 19839 | 957 |
| 19840 | 918 |
| 19841 | 866 |
| 19842 | 900 |
| 19843 | 942 |
| 19844 | 1002 |
| 19845 | 1119 |
| 19846 | 1230 |
| 19847 | 1300 |
| 19848 | 1315 |
| 19849 | 1356 |
| 19850 | 1373 |
| 19851 | 1396 |
| 19852 | 1422 |
| 19853 | 1436 |
| 19854 | 1439 |
| 19855 | 1451 |
| 19856 | 1447 |
| 19857 | 1421 |
| 19858 | 1386 |
| 19859 | 1372 |
| 19860 | 1373 |
| 19861 | 1359 |
| 19862 | 1373 |
| 19863 | 1397 |
| 19864 | 1348 |
| 19865 | 1285 |
| 19866 | 1217 |
| 19867 | 1153 |
| 19868 | 1084 |
| 19869 | 1029 |
| 19870 | 982 |
| 19871 | 936 |
| 19872 | 910 |
| 19873 | 878 |
| 19874 | 851 |
| 19875 | 831 |
| 19876 | 814 |
| 19877 | 799 |
| 19878 | 787 |
| 19879 | 780 |
| 19880 | 771 |
| 19881 | 758 |
| 19882 | 768 |
| 19883 | 766 |
| 19884 | 758 |
| 19885 | 747 |
| 19886 | 753 |
| 19887 | 764 |
| 19888 | 780 |
| 19889 | 773 |
| 19890 | 785 |
| 19891 | 806 |
| 19892 | 843 |
| 19893 | 862 |
| 19894 | 872 |
| 19895 | 911 |
| 19896 | 977 |
| 19897 | 1011 |
| 19898 | 1051 |
| 19899 | 1075 |
| 19900 | 1119 |
| 19901 | 1150 |
| 19902 | 1172 |
| 19903 | 1190 |
| 19904 | 1185 |
| 19905 | 1192 |
| 19906 | 1172 |
| 19907 | 1140 |
| 19908 | 1113 |
| 19909 | 1056 |
| 19910 | 998 |
| 19911 | 999 |
| 19912 | 998 |
| 19913 | 1011 |
| 19914 | 1032 |
| 19915 | 1059 |
| 19916 | 1081 |
| 19917 | 1048 |
| 19918 | 1109 |
| 19919 | 1075 |
| 19920 | 1048 |
| 19921 | 1017 |
| 19922 | 933 |
| 19923 | 873 |
| 19924 | 814 |
| 19925 | 899 |
| 19926 | 954 |
| 19927 | 972 |
| 19928 | 983 |
| 19929 | 878 |
| 19930 | 791 |
| 19931 | 709 |
| 19932 | 711 |
| 19933 | 828 |
| 19934 | 846 |
| 19935 | 839 |
| 19936 | 904 |
| 19937 | 987 |
| 19938 | 1049 |
| 19939 | 1041 |
| 19940 | 1032 |
| 19941 | 1089 |
| 19942 | 1119 |
| 19943 | 1159 |
| 19944 | 1167 |
| 19945 | 1198 |
| 19946 | 1245 |
| 19947 | 1287 |
| 19948 | 1294 |
| 19949 | 1333 |
| 19950 | 1374 |
| 19951 | 1384 |
| 19952 | 1380 |
| 19953 | 1376 |
| 19954 | 1389 |
| 19955 | 1396 |
| 19956 | 1391 |
| 19957 | 1393 |
| 19958 | 1402 |
| 19959 | 1404 |
| 19960 | 1350 |
| 19961 | 1285 |
| 19962 | 1219 |
| 19963 | 1153 |
| 19964 | 1083 |
| 19965 | 1035 |
| 19966 | 985 |
| 19967 | 946 |
| 19968 | 916 |
| 19969 | 882 |
| 19970 | 854 |
| 19971 | 832 |
| 19972 | 818 |
| 19973 | 800 |
| 19974 | 783 |
| 19975 | 772 |
| 19976 | 765 |
| 19977 | 756 |
| 19978 | 752 |
| 19979 | 752 |
| 19980 | 756 |
| 19981 | 753 |
| 19982 | 754 |
| 19983 | 759 |
| 19984 | 774 |
| 19985 | 779 |
| 19986 | 794 |
| 19987 | 816 |
| 19988 | 855 |
| 19989 | 861 |
| 19990 | 885 |
| 19991 | 905 |
| 19992 | 973 |
| 19993 | 1017 |
| 19994 | 1047 |
| 19995 | 1069 |
| 19996 | 1116 |
| 19997 | 1163 |
| 19998 | 1193 |
| 19999 | 1207 |
| 20000 | 1219 |
| 20001 | 1232 |
| 20002 | 1232 |
| 20003 | 1219 |
| 20004 | 1183 |
| 20005 | 1160 |
| 20006 | 1159 |
| 20007 | 1122 |
| 20008 | 1103 |
| 20009 | 1075 |
| 20010 | 1055 |
| 20011 | 1064 |
| 20012 | 1082 |
| 20013 | 1053 |
| 20014 | 1063 |
| 20015 | 1070 |
| 20016 | 1025 |
| 20017 | 990 |
| 20018 | 952 |
| 20019 | 965 |
| 20020 | 961 |
| 20021 | 1001 |
| 20022 | 1006 |
| 20023 | 996 |
| 20024 | 952 |
| 20025 | 983 |
| 20026 | 1018 |
| 20027 | 982 |
| 20028 | 926 |
| 20029 | 890 |
| 20030 | 945 |
| 20031 | 950 |
| 20032 | 957 |
| 20033 | 996 |
| 20034 | 1025 |
| 20035 | 1052 |
| 20036 | 1072 |
| 20037 | 1097 |
| 20038 | 1135 |
| 20039 | 1191 |
| 20040 | 1246 |
| 20041 | 1307 |
| 20042 | 1355 |
| 20043 | 1368 |
| 20044 | 1364 |
| 20045 | 1352 |
| 20046 | 1361 |
| 20047 | 1384 |
| 20048 | 1393 |
| 20049 | 1378 |
| 20050 | 1371 |
| 20051 | 1383 |
| 20052 | 1365 |
| 20053 | 1385 |
| 20054 | 1387 |
| 20055 | 1399 |
| 20056 | 1344 |
| 20057 | 1289 |
| 20058 | 1223 |
| 20059 | 1156 |
| 20060 | 1077 |
| 20061 | 1023 |
| 20062 | 974 |
| 20063 | 933 |
| 20064 | 902 |
| 20065 | 877 |
| 20066 | 850 |
| 20067 | 825 |
| 20068 | 805 |
| 20069 | 787 |
| 20070 | 777 |
| 20071 | 769 |
| 20072 | 763 |
| 20073 | 753 |
| 20074 | 751 |
| 20075 | 752 |
| 20076 | 752 |
| 20077 | 747 |
| 20078 | 746 |
| 20079 | 748 |
| 20080 | 769 |
| 20081 | 773 |
| 20082 | 791 |
| 20083 | 812 |
| 20084 | 848 |
| 20085 | 854 |
| 20086 | 856 |
| 20087 | 874 |
| 20088 | 942 |
| 20089 | 990 |
| 20090 | 1020 |
| 20091 | 1050 |
| 20092 | 1109 |
| 20093 | 1145 |
| 20094 | 1165 |
| 20095 | 1191 |
| 20096 | 1193 |
| 20097 | 1189 |
| 20098 | 1177 |
| 20099 | 1171 |
| 20100 | 1145 |
| 20101 | 1137 |
| 20102 | 1111 |
| 20103 | 1083 |
| 20104 | 1082 |
| 20105 | 1050 |
| 20106 | 988 |
| 20107 | 987 |
| 20108 | 976 |
| 20109 | 956 |
| 20110 | 960 |
| 20111 | 951 |
| 20112 | 929 |
| 20113 | 879 |
| 20114 | 817 |
| 20115 | 798 |
| 20116 | 756 |
| 20117 | 762 |
| 20118 | 676 |
| 20119 | 707 |
| 20120 | 757 |
| 20121 | 730 |
| 20122 | 743 |
| 20123 | 736 |
| 20124 | 756 |
| 20125 | 792 |
| 20126 | 821 |
| 20127 | 844 |
| 20128 | 858 |
| 20129 | 873 |
| 20130 | 891 |
| 20131 | 872 |
| 20132 | 945 |
| 20133 | 1013 |
| 20134 | 1082 |
| 20135 | 1110 |
| 20136 | 1159 |
| 20137 | 1215 |
| 20138 | 1239 |
| 20139 | 1220 |
| 20140 | 1237 |
| 20141 | 1271 |
| 20142 | 1312 |
| 20143 | 1355 |
| 20144 | 1357 |
| 20145 | 1348 |
| 20146 | 1342 |
| 20147 | 1344 |
| 20148 | 1321 |
| 20149 | 1326 |
| 20150 | 1345 |
| 20151 | 1376 |
| 20152 | 1336 |
| 20153 | 1280 |
| 20154 | 1219 |
| 20155 | 1160 |
| 20156 | 1098 |
| 20157 | 1041 |
| 20158 | 993 |
| 20159 | 949 |
| 20160 | 922 |
| 20161 | 895 |
| 20162 | 865 |
| 20163 | 843 |
| 20164 | 820 |
| 20165 | 801 |
| 20166 | 782 |
| 20167 | 773 |
| 20168 | 768 |
| 20169 | 760 |
| 20170 | 753 |
| 20171 | 750 |
| 20172 | 746 |
| 20173 | 744 |
| 20174 | 747 |
| 20175 | 750 |
| 20176 | 767 |
| 20177 | 774 |
| 20178 | 788 |
| 20179 | 805 |
| 20180 | 846 |
| 20181 | 860 |
| 20182 | 861 |
| 20183 | 883 |
| 20184 | 953 |
| 20185 | 998 |
| 20186 | 1028 |
| 20187 | 1045 |
| 20188 | 1085 |
| 20189 | 1115 |
| 20190 | 1124 |
| 20191 | 1118 |
| 20192 | 1124 |
| 20193 | 1109 |
| 20194 | 1085 |
| 20195 | 1053 |
| 20196 | 1004 |
| 20197 | 961 |
| 20198 | 945 |
| 20199 | 909 |
| 20200 | 888 |
| 20201 | 846 |
| 20202 | 799 |
| 20203 | 795 |
| 20204 | 819 |
| 20205 | 813 |
| 20206 | 813 |
| 20207 | 800 |
| 20208 | 758 |
| 20209 | 752 |
| 20210 | 703 |
| 20211 | 681 |
| 20212 | 677 |
| 20213 | 617 |
| 20214 | 633 |
| 20215 | 599 |
| 20216 | 592 |
| 20217 | 600 |
| 20218 | 621 |
| 20219 | 640 |
| 20220 | 669 |
| 20221 | 671 |
| 20222 | 716 |
| 20223 | 782 |
| 20224 | 809 |
| 20225 | 849 |
| 20226 | 892 |
| 20227 | 956 |
| 20228 | 1027 |
| 20229 | 1084 |
| 20230 | 1138 |
| 20231 | 1206 |
| 20232 | 1233 |
| 20233 | 1278 |
| 20234 | 1319 |
| 20235 | 1352 |
| 20236 | 1353 |
| 20237 | 1324 |
| 20238 | 1309 |
| 20239 | 1314 |
| 20240 | 1309 |
| 20241 | 1300 |
| 20242 | 1307 |
| 20243 | 1316 |
| 20244 | 1301 |
| 20245 | 1312 |
| 20246 | 1329 |
| 20247 | 1356 |
| 20248 | 1315 |
| 20249 | 1275 |
| 20250 | 1226 |
| 20251 | 1176 |
| 20252 | 1119 |
| 20253 | 1071 |
| 20254 | 1025 |
| 20255 | 982 |
| 20256 | 951 |
| 20257 | 917 |
| 20258 | 884 |
| 20259 | 860 |
| 20260 | 839 |
| 20261 | 818 |
| 20262 | 803 |
| 20263 | 788 |
| 20264 | 783 |
| 20265 | 773 |
| 20266 | 764 |
| 20267 | 761 |
| 20268 | 761 |
| 20269 | 752 |
| 20270 | 746 |
| 20271 | 741 |
| 20272 | 755 |
| 20273 | 751 |
| 20274 | 754 |
| 20275 | 756 |
| 20276 | 770 |
| 20277 | 766 |
| 20278 | 761 |
| 20279 | 748 |
| 20280 | 786 |
| 20281 | 809 |
| 20282 | 810 |
| 20283 | 817 |
| 20284 | 837 |
| 20285 | 844 |
| 20286 | 848 |
| 20287 | 870 |
| 20288 | 901 |
| 20289 | 919 |
| 20290 | 897 |
| 20291 | 886 |
| 20292 | 912 |
| 20293 | 916 |
| 20294 | 949 |
| 20295 | 926 |
| 20296 | 904 |
| 20297 | 890 |
| 20298 | 827 |
| 20299 | 805 |
| 20300 | 886 |
| 20301 | 951 |
| 20302 | 944 |
| 20303 | 938 |
| 20304 | 922 |
| 20305 | 884 |
| 20306 | 864 |
| 20307 | 859 |
| 20308 | 816 |
| 20309 | 758 |
| 20310 | 718 |
| 20311 | 700 |
| 20312 | 693 |
| 20313 | 708 |
| 20314 | 706 |
| 20315 | 778 |
| 20316 | 778 |
| 20317 | 803 |
| 20318 | 802 |
| 20319 | 796 |
| 20320 | 824 |
| 20321 | 857 |
| 20322 | 916 |
| 20323 | 951 |
| 20324 | 989 |
| 20325 | 988 |
| 20326 | 1041 |
| 20327 | 1052 |
| 20328 | 1083 |
| 20329 | 1118 |
| 20330 | 1172 |
| 20331 | 1187 |
| 20332 | 1194 |
| 20333 | 1191 |
| 20334 | 1215 |
| 20335 | 1237 |
| 20336 | 1244 |
| 20337 | 1244 |
| 20338 | 1248 |
| 20339 | 1254 |
| 20340 | 1253 |
| 20341 | 1266 |
| 20342 | 1290 |
| 20343 | 1298 |
| 20344 | 1259 |
| 20345 | 1224 |
| 20346 | 1184 |
| 20347 | 1143 |
| 20348 | 1094 |
| 20349 | 1052 |
| 20350 | 1007 |
| 20351 | 970 |
| 20352 | 940 |
| 20353 | 908 |
| 20354 | 880 |
| 20355 | 856 |
| 20356 | 835 |
| 20357 | 806 |
| 20358 | 794 |
| 20359 | 780 |
| 20360 | 766 |
| 20361 | 751 |
| 20362 | 741 |
| 20363 | 740 |
| 20364 | 732 |
| 20365 | 724 |
| 20366 | 716 |
| 20367 | 718 |
| 20368 | 721 |
| 20369 | 722 |
| 20370 | 726 |
| 20371 | 731 |
| 20372 | 740 |
| 20373 | 736 |
| 20374 | 718 |
| 20375 | 708 |
| 20376 | 702 |
| 20377 | 707 |
| 20378 | 708 |
| 20379 | 717 |
| 20380 | 726 |
| 20381 | 738 |
| 20382 | 743 |
| 20383 | 751 |
| 20384 | 743 |
| 20385 | 741 |
| 20386 | 736 |
| 20387 | 736 |
| 20388 | 738 |
| 20389 | 756 |
| 20390 | 762 |
| 20391 | 790 |
| 20392 | 750 |
| 20393 | 707 |
| 20394 | 651 |
| 20395 | 643 |
| 20396 | 659 |
| 20397 | 645 |
| 20398 | 650 |
| 20399 | 670 |
| 20400 | 649 |
| 20401 | 595 |
| 20402 | 512 |
| 20403 | 533 |
| 20404 | 527 |
| 20405 | 541 |
| 20406 | 548 |
| 20407 | 628 |
| 20408 | 665 |
| 20409 | 701 |
| 20410 | 731 |
| 20411 | 760 |
| 20412 | 750 |
| 20413 | 776 |
| 20414 | 763 |
| 20415 | 774 |
| 20416 | 811 |
| 20417 | 832 |
| 20418 | 857 |
| 20419 | 851 |
| 20420 | 888 |
| 20421 | 907 |
| 20422 | 967 |
| 20423 | 1002 |
| 20424 | 1061 |
| 20425 | 1113 |
| 20426 | 1147 |
| 20427 | 1181 |
| 20428 | 1203 |
| 20429 | 1230 |
| 20430 | 1244 |
| 20431 | 1277 |
| 20432 | 1277 |
| 20433 | 1257 |
| 20434 | 1249 |
| 20435 | 1239 |
| 20436 | 1254 |
| 20437 | 1275 |
| 20438 | 1292 |
| 20439 | 1299 |
| 20440 | 1248 |
| 20441 | 1199 |
| 20442 | 1144 |
| 20443 | 1086 |
| 20444 | 1020 |
| 20445 | 963 |
| 20446 | 919 |
| 20447 | 881 |
| 20448 | 859 |
| 20449 | 821 |
| 20450 | 791 |
| 20451 | 770 |
| 20452 | 762 |
| 20453 | 751 |
| 20454 | 737 |
| 20455 | 727 |
| 20456 | 722 |
| 20457 | 716 |
| 20458 | 717 |
| 20459 | 716 |
| 20460 | 712 |
| 20461 | 707 |
| 20462 | 709 |
| 20463 | 710 |
| 20464 | 734 |
| 20465 | 739 |
| 20466 | 754 |
| 20467 | 773 |
| 20468 | 820 |
| 20469 | 831 |
| 20470 | 846 |
| 20471 | 870 |
| 20472 | 942 |
| 20473 | 981 |
| 20474 | 1009 |
| 20475 | 1041 |
| 20476 | 1102 |
| 20477 | 1135 |
| 20478 | 1150 |
| 20479 | 1162 |
| 20480 | 1178 |
| 20481 | 1179 |
| 20482 | 1161 |
| 20483 | 1130 |
| 20484 | 1097 |
| 20485 | 1071 |
| 20486 | 1052 |
| 20487 | 1046 |
| 20488 | 1063 |
| 20489 | 993 |
| 20490 | 915 |
| 20491 | 894 |
| 20492 | 827 |
| 20493 | 782 |
| 20494 | 786 |
| 20495 | 756 |
| 20496 | 723 |
| 20497 | 696 |
| 20498 | 658 |
| 20499 | 660 |
| 20500 | 710 |
| 20501 | 721 |
| 20502 | 780 |
| 20503 | 798 |
| 20504 | 771 |
| 20505 | 741 |
| 20506 | 716 |
| 20507 | 775 |
| 20508 | 826 |
| 20509 | 830 |
| 20510 | 838 |
| 20511 | 823 |
| 20512 | 791 |
| 20513 | 721 |
| 20514 | 776 |
| 20515 | 816 |
| 20516 | 881 |
| 20517 | 1048 |
| 20518 | 1197 |
| 20519 | 1276 |
| 20520 | 1287 |
| 20521 | 1331 |
| 20522 | 1331 |
| 20523 | 1320 |
| 20524 | 1339 |
| 20525 | 1357 |
| 20526 | 1374 |
| 20527 | 1398 |
| 20528 | 1399 |
| 20529 | 1378 |
| 20530 | 1349 |
| 20531 | 1342 |
| 20532 | 1356 |
| 20533 | 1372 |
| 20534 | 1386 |
| 20535 | 1376 |
| 20536 | 1319 |
| 20537 | 1249 |
| 20538 | 1193 |
| 20539 | 1128 |
| 20540 | 1062 |
| 20541 | 1007 |
| 20542 | 961 |
| 20543 | 916 |
| 20544 | 888 |
| 20545 | 855 |
| 20546 | 828 |
| 20547 | 808 |
| 20548 | 792 |
| 20549 | 778 |
| 20550 | 768 |
| 20551 | 761 |
| 20552 | 756 |
| 20553 | 743 |
| 20554 | 746 |
| 20555 | 739 |
| 20556 | 732 |
| 20557 | 723 |
| 20558 | 733 |
| 20559 | 744 |
| 20560 | 759 |
| 20561 | 755 |
| 20562 | 765 |
| 20563 | 783 |
| 20564 | 817 |
| 20565 | 837 |
| 20566 | 856 |
| 20567 | 888 |
| 20568 | 946 |
| 20569 | 979 |
| 20570 | 1004 |
| 20571 | 1031 |
| 20572 | 1081 |
| 20573 | 1096 |
| 20574 | 1116 |
| 20575 | 1135 |
| 20576 | 1149 |
| 20577 | 1181 |
| 20578 | 1179 |
| 20579 | 1151 |
| 20580 | 1102 |
| 20581 | 1046 |
| 20582 | 990 |
| 20583 | 985 |
| 20584 | 979 |
| 20585 | 977 |
| 20586 | 1003 |
| 20587 | 1031 |
| 20588 | 1085 |
| 20589 | 1092 |
| 20590 | 1118 |
| 20591 | 1080 |
| 20592 | 1090 |
| 20593 | 1078 |
| 20594 | 965 |
| 20595 | 874 |
| 20596 | 812 |
| 20597 | 867 |
| 20598 | 922 |
| 20599 | 936 |
| 20600 | 939 |
| 20601 | 858 |
| 20602 | 766 |
| 20603 | 719 |
| 20604 | 721 |
| 20605 | 786 |
| 20606 | 846 |
| 20607 | 888 |
| 20608 | 916 |
| 20609 | 945 |
| 20610 | 1002 |
| 20611 | 1018 |
| 20612 | 1068 |
| 20613 | 1098 |
| 20614 | 1124 |
| 20615 | 1163 |
| 20616 | 1174 |
| 20617 | 1189 |
| 20618 | 1238 |
| 20619 | 1282 |
| 20620 | 1299 |
| 20621 | 1334 |
| 20622 | 1376 |
| 20623 | 1391 |
| 20624 | 1391 |
| 20625 | 1378 |
| 20626 | 1385 |
| 20627 | 1390 |
| 20628 | 1396 |
| 20629 | 1421 |
| 20630 | 1416 |
| 20631 | 1390 |
| 20632 | 1325 |
| 20633 | 1263 |
| 20634 | 1199 |
| 20635 | 1133 |
| 20636 | 1062 |
| 20637 | 1016 |
| 20638 | 973 |
| 20639 | 933 |
| 20640 | 905 |
| 20641 | 876 |
| 20642 | 849 |
| 20643 | 827 |
| 20644 | 812 |
| 20645 | 796 |
| 20646 | 782 |
| 20647 | 772 |
| 20648 | 765 |
| 20649 | 756 |
| 20650 | 753 |
| 20651 | 755 |
| 20652 | 756 |
| 20653 | 752 |
| 20654 | 752 |
| 20655 | 757 |
| 20656 | 776 |
| 20657 | 780 |
| 20658 | 795 |
| 20659 | 816 |
| 20660 | 857 |
| 20661 | 868 |
| 20662 | 896 |
| 20663 | 909 |
| 20664 | 971 |
| 20665 | 1010 |
| 20666 | 1043 |
| 20667 | 1070 |
| 20668 | 1124 |
| 20669 | 1156 |
| 20670 | 1188 |
| 20671 | 1197 |
| 20672 | 1206 |
| 20673 | 1211 |
| 20674 | 1192 |
| 20675 | 1193 |
| 20676 | 1180 |
| 20677 | 1172 |
| 20678 | 1155 |
| 20679 | 1118 |
| 20680 | 1115 |
| 20681 | 1091 |
| 20682 | 1076 |
| 20683 | 1114 |
| 20684 | 1186 |
| 20685 | 1250 |
| 20686 | 1291 |
| 20687 | 1310 |
| 20688 | 1248 |
| 20689 | 1210 |
| 20690 | 1197 |
| 20691 | 1210 |
| 20692 | 1196 |
| 20693 | 1180 |
| 20694 | 1140 |
| 20695 | 1145 |
| 20696 | 1158 |
| 20697 | 1132 |
| 20698 | 1151 |
| 20699 | 1171 |
| 20700 | 1148 |
| 20701 | 1127 |
| 20702 | 1167 |
| 20703 | 1172 |
| 20704 | 1186 |
| 20705 | 1158 |
| 20706 | 1151 |
| 20707 | 1186 |
| 20708 | 1237 |
| 20709 | 1273 |
| 20710 | 1324 |
| 20711 | 1387 |
| 20712 | 1433 |
| 20713 | 1471 |
| 20714 | 1504 |
| 20715 | 1506 |
| 20716 | 1487 |
| 20717 | 1470 |
| 20718 | 1470 |
| 20719 | 1479 |
| 20720 | 1476 |
| 20721 | 1455 |
| 20722 | 1433 |
| 20723 | 1422 |
| 20724 | 1413 |
| 20725 | 1425 |
| 20726 | 1417 |
| 20727 | 1394 |
| 20728 | 1318 |
| 20729 | 1258 |
| 20730 | 1193 |
| 20731 | 1128 |
| 20732 | 1045 |
| 20733 | 994 |
| 20734 | 949 |
| 20735 | 911 |
| 20736 | 882 |
| 20737 | 857 |
| 20738 | 832 |
| 20739 | 811 |
| 20740 | 792 |
| 20741 | 776 |
| 20742 | 765 |
| 20743 | 759 |
| 20744 | 753 |
| 20745 | 744 |
| 20746 | 739 |
| 20747 | 737 |
| 20748 | 738 |
| 20749 | 738 |
| 20750 | 739 |
| 20751 | 743 |
| 20752 | 761 |
| 20753 | 762 |
| 20754 | 779 |
| 20755 | 800 |
| 20756 | 835 |
| 20757 | 847 |
| 20758 | 863 |
| 20759 | 909 |
| 20760 | 977 |
| 20761 | 1004 |
| 20762 | 1038 |
| 20763 | 1071 |
| 20764 | 1129 |
| 20765 | 1162 |
| 20766 | 1188 |
| 20767 | 1209 |
| 20768 | 1217 |
| 20769 | 1226 |
| 20770 | 1208 |
| 20771 | 1197 |
| 20772 | 1163 |
| 20773 | 1168 |
| 20774 | 1165 |
| 20775 | 1159 |
| 20776 | 1128 |
| 20777 | 1117 |
| 20778 | 1120 |
| 20779 | 1135 |
| 20780 | 1117 |
| 20781 | 1058 |
| 20782 | 1081 |
| 20783 | 1074 |
| 20784 | 1012 |
| 20785 | 1010 |
| 20786 | 972 |
| 20787 | 944 |
| 20788 | 912 |
| 20789 | 915 |
| 20790 | 770 |
| 20791 | 764 |
| 20792 | 748 |
| 20793 | 653 |
| 20794 | 711 |
| 20795 | 727 |
| 20796 | 712 |
| 20797 | 785 |
| 20798 | 831 |
| 20799 | 795 |
| 20800 | 765 |
| 20801 | 809 |
| 20802 | 892 |
| 20803 | 936 |
| 20804 | 961 |
| 20805 | 1024 |
| 20806 | 1096 |
| 20807 | 1157 |
| 20808 | 1178 |
| 20809 | 1196 |
| 20810 | 1240 |
| 20811 | 1277 |
| 20812 | 1295 |
| 20813 | 1306 |
| 20814 | 1340 |
| 20815 | 1378 |
| 20816 | 1384 |
| 20817 | 1387 |
| 20818 | 1390 |
| 20819 | 1396 |
| 20820 | 1408 |
| 20821 | 1413 |
| 20822 | 1424 |
| 20823 | 1404 |
| 20824 | 1346 |
| 20825 | 1286 |
| 20826 | 1229 |
| 20827 | 1164 |
| 20828 | 1100 |
| 20829 | 1038 |
| 20830 | 990 |
| 20831 | 949 |
| 20832 | 923 |
| 20833 | 890 |
| 20834 | 860 |
| 20835 | 836 |
| 20836 | 814 |
| 20837 | 798 |
| 20838 | 781 |
| 20839 | 770 |
| 20840 | 765 |
| 20841 | 759 |
| 20842 | 751 |
| 20843 | 747 |
| 20844 | 746 |
| 20845 | 738 |
| 20846 | 741 |
| 20847 | 745 |
| 20848 | 758 |
| 20849 | 765 |
| 20850 | 780 |
| 20851 | 798 |
| 20852 | 836 |
| 20853 | 855 |
| 20854 | 866 |
| 20855 | 892 |
| 20856 | 961 |
| 20857 | 991 |
| 20858 | 1022 |
| 20859 | 1045 |
| 20860 | 1084 |
| 20861 | 1115 |
| 20862 | 1145 |
| 20863 | 1162 |
| 20864 | 1176 |
| 20865 | 1175 |
| 20866 | 1179 |
| 20867 | 1178 |
| 20868 | 1137 |
| 20869 | 1095 |
| 20870 | 1073 |
| 20871 | 1079 |
| 20872 | 1086 |
| 20873 | 1058 |
| 20874 | 1038 |
| 20875 | 1035 |
| 20876 | 1065 |
| 20877 | 1096 |
| 20878 | 1103 |
| 20879 | 1092 |
| 20880 | 1055 |
| 20881 | 1004 |
| 20882 | 945 |
| 20883 | 907 |
| 20884 | 863 |
| 20885 | 814 |
| 20886 | 851 |
| 20887 | 803 |
| 20888 | 738 |
| 20889 | 764 |
| 20890 | 791 |
| 20891 | 833 |
| 20892 | 850 |
| 20893 | 850 |
| 20894 | 898 |
| 20895 | 962 |
| 20896 | 993 |
| 20897 | 1019 |
| 20898 | 1048 |
| 20899 | 1091 |
| 20900 | 1110 |
| 20901 | 1138 |
| 20902 | 1202 |
| 20903 | 1259 |
| 20904 | 1274 |
| 20905 | 1312 |
| 20906 | 1358 |
| 20907 | 1398 |
| 20908 | 1395 |
| 20909 | 1368 |
| 20910 | 1350 |
| 20911 | 1361 |
| 20912 | 1361 |
| 20913 | 1345 |
| 20914 | 1344 |
| 20915 | 1348 |
| 20916 | 1363 |
| 20917 | 1376 |
| 20918 | 1386 |
| 20919 | 1370 |
| 20920 | 1315 |
| 20921 | 1266 |
| 20922 | 1214 |
| 20923 | 1163 |
| 20924 | 1109 |
| 20925 | 1061 |
| 20926 | 1015 |
| 20927 | 973 |
| 20928 | 942 |
| 20929 | 907 |
| 20930 | 876 |
| 20931 | 851 |
| 20932 | 832 |
| 20933 | 809 |
| 20934 | 793 |
| 20935 | 775 |
| 20936 | 767 |
| 20937 | 758 |
| 20938 | 749 |
| 20939 | 748 |
| 20940 | 745 |
| 20941 | 737 |
| 20942 | 730 |
| 20943 | 730 |
| 20944 | 741 |
| 20945 | 737 |
| 20946 | 738 |
| 20947 | 742 |
| 20948 | 758 |
| 20949 | 757 |
| 20950 | 763 |
| 20951 | 763 |
| 20952 | 800 |
| 20953 | 808 |
| 20954 | 818 |
| 20955 | 833 |
| 20956 | 857 |
| 20957 | 860 |
| 20958 | 874 |
| 20959 | 909 |
| 20960 | 951 |
| 20961 | 967 |
| 20962 | 943 |
| 20963 | 953 |
| 20964 | 980 |
| 20965 | 975 |
| 20966 | 1010 |
| 20967 | 967 |
| 20968 | 994 |
| 20969 | 1016 |
| 20970 | 952 |
| 20971 | 908 |
| 20972 | 989 |
| 20973 | 1031 |
| 20974 | 973 |
| 20975 | 1028 |
| 20976 | 1055 |
| 20977 | 1035 |
| 20978 | 992 |
| 20979 | 932 |
| 20980 | 802 |
| 20981 | 695 |
| 20982 | 691 |
| 20983 | 772 |
| 20984 | 693 |
| 20985 | 629 |
| 20986 | 588 |
| 20987 | 623 |
| 20988 | 683 |
| 20989 | 759 |
| 20990 | 734 |
| 20991 | 714 |
| 20992 | 785 |
| 20993 | 779 |
| 20994 | 829 |
| 20995 | 918 |
| 20996 | 977 |
| 20997 | 986 |
| 20998 | 1016 |
| 20999 | 991 |
| 21000 | 1034 |
| 21001 | 1084 |
| 21002 | 1140 |
| 21003 | 1166 |
| 21004 | 1188 |
| 21005 | 1204 |
| 21006 | 1226 |
| 21007 | 1255 |
| 21008 | 1273 |
| 21009 | 1284 |
| 21010 | 1292 |
| 21011 | 1305 |
| 21012 | 1312 |
| 21013 | 1321 |
| 21014 | 1327 |
| 21015 | 1312 |
| 21016 | 1265 |
| 21017 | 1222 |
| 21018 | 1178 |
| 21019 | 1131 |
| 21020 | 1077 |
| 21021 | 1039 |
| 21022 | 994 |
| 21023 | 955 |
| 21024 | 929 |
| 21025 | 897 |
| 21026 | 870 |
| 21027 | 844 |
| 21028 | 822 |
| 21029 | 795 |
| 21030 | 780 |
| 21031 | 765 |
| 21032 | 754 |
| 21033 | 739 |
| 21034 | 730 |
| 21035 | 726 |
| 21036 | 719 |
| 21037 | 710 |
| 21038 | 704 |
| 21039 | 705 |
| 21040 | 708 |
| 21041 | 708 |
| 21042 | 712 |
| 21043 | 716 |
| 21044 | 721 |
| 21045 | 719 |
| 21046 | 714 |
| 21047 | 708 |
| 21048 | 701 |
| 21049 | 700 |
| 21050 | 703 |
| 21051 | 711 |
| 21052 | 730 |
| 21053 | 749 |
| 21054 | 759 |
| 21055 | 764 |
| 21056 | 774 |
| 21057 | 789 |
| 21058 | 801 |
| 21059 | 835 |
| 21060 | 851 |
| 21061 | 882 |
| 21062 | 870 |
| 21063 | 883 |
| 21064 | 801 |
| 21065 | 735 |
| 21066 | 677 |
| 21067 | 662 |
| 21068 | 714 |
| 21069 | 724 |
| 21070 | 784 |
| 21071 | 822 |
| 21072 | 845 |
| 21073 | 801 |
| 21074 | 675 |
| 21075 | 674 |
| 21076 | 667 |
| 21077 | 674 |
| 21078 | 664 |
| 21079 | 767 |
| 21080 | 789 |
| 21081 | 811 |
| 21082 | 845 |
| 21083 | 875 |
| 21084 | 883 |
| 21085 | 878 |
| 21086 | 885 |
| 21087 | 877 |
| 21088 | 842 |
| 21089 | 839 |
| 21090 | 885 |
| 21091 | 922 |
| 21092 | 956 |
| 21093 | 993 |
| 21094 | 1063 |
| 21095 | 1117 |
| 21096 | 1178 |
| 21097 | 1220 |
| 21098 | 1242 |
| 21099 | 1258 |
| 21100 | 1275 |
| 21101 | 1295 |
| 21102 | 1295 |
| 21103 | 1309 |
| 21104 | 1298 |
| 21105 | 1264 |
| 21106 | 1251 |
| 21107 | 1246 |
| 21108 | 1271 |
| 21109 | 1287 |
| 21110 | 1284 |
| 21111 | 1275 |
| 21112 | 1214 |
| 21113 | 1158 |
| 21114 | 1100 |
| 21115 | 1040 |
| 21116 | 973 |
| 21117 | 917 |
| 21118 | 881 |
| 21119 | 848 |
| 21120 | 818 |
| 21121 | 780 |
| 21122 | 753 |
| 21123 | 729 |
| 21124 | 719 |
| 21125 | 712 |
| 21126 | 696 |
| 21127 | 686 |
| 21128 | 684 |
| 21129 | 677 |
| 21130 | 678 |
| 21131 | 676 |
| 21132 | 675 |
| 21133 | 672 |
| 21134 | 670 |
| 21135 | 671 |
| 21136 | 695 |
| 21137 | 700 |
| 21138 | 717 |
| 21139 | 737 |
| 21140 | 781 |
| 21141 | 794 |
| 21142 | 816 |
| 21143 | 852 |
| 21144 | 915 |
| 21145 | 950 |
| 21146 | 975 |
| 21147 | 1011 |
| 21148 | 1068 |
| 21149 | 1105 |
| 21150 | 1121 |
| 21151 | 1136 |
| 21152 | 1168 |
| 21153 | 1176 |
| 21154 | 1161 |
| 21155 | 1119 |
| 21156 | 1083 |
| 21157 | 1074 |
| 21158 | 1091 |
| 21159 | 1092 |
| 21160 | 1129 |
| 21161 | 1106 |
| 21162 | 1081 |
| 21163 | 1089 |
| 21164 | 1031 |
| 21165 | 1023 |
| 21166 | 1045 |
| 21167 | 963 |
| 21168 | 884 |
| 21169 | 776 |
| 21170 | 747 |
| 21171 | 746 |
| 21172 | 783 |
| 21173 | 780 |
| 21174 | 830 |
| 21175 | 830 |
| 21176 | 751 |
| 21177 | 734 |
| 21178 | 766 |
| 21179 | 765 |
| 21180 | 826 |
| 21181 | 815 |
| 21182 | 876 |
| 21183 | 819 |
| 21184 | 875 |
| 21185 | 869 |
| 21186 | 943 |
| 21187 | 967 |
| 21188 | 939 |
| 21189 | 1018 |
| 21190 | 1129 |
| 21191 | 1224 |
| 21192 | 1264 |
| 21193 | 1317 |
| 21194 | 1339 |
| 21195 | 1334 |
| 21196 | 1349 |
| 21197 | 1375 |
| 21198 | 1388 |
| 21199 | 1413 |
| 21200 | 1419 |
| 21201 | 1397 |
| 21202 | 1383 |
| 21203 | 1386 |
| 21204 | 1398 |
| 21205 | 1408 |
| 21206 | 1396 |
| 21207 | 1366 |
| 21208 | 1301 |
| 21209 | 1234 |
| 21210 | 1182 |
| 21211 | 1120 |
| 21212 | 1055 |
| 21213 | 998 |
| 21214 | 948 |
| 21215 | 898 |
| 21216 | 874 |
| 21217 | 847 |
| 21218 | 817 |
| 21219 | 798 |
| 21220 | 782 |
| 21221 | 770 |
| 21222 | 756 |
| 21223 | 747 |
| 21224 | 744 |
| 21225 | 735 |
| 21226 | 735 |
| 21227 | 729 |
| 21228 | 726 |
| 21229 | 723 |
| 21230 | 732 |
| 21231 | 735 |
| 21232 | 751 |
| 21233 | 756 |
| 21234 | 768 |
| 21235 | 783 |
| 21236 | 822 |
| 21237 | 841 |
| 21238 | 868 |
| 21239 | 908 |
| 21240 | 952 |
| 21241 | 987 |
| 21242 | 1003 |
| 21243 | 1029 |
| 21244 | 1088 |
| 21245 | 1107 |
| 21246 | 1132 |
| 21247 | 1149 |
| 21248 | 1167 |
| 21249 | 1160 |
| 21250 | 1153 |
| 21251 | 1112 |
| 21252 | 1061 |
| 21253 | 1033 |
| 21254 | 991 |
| 21255 | 971 |
| 21256 | 942 |
| 21257 | 873 |
| 21258 | 842 |
| 21259 | 837 |
| 21260 | 889 |
| 21261 | 924 |
| 21262 | 947 |
| 21263 | 924 |
| 21264 | 944 |
| 21265 | 906 |
| 21266 | 841 |
| 21267 | 769 |
| 21268 | 715 |
| 21269 | 767 |
| 21270 | 768 |
| 21271 | 754 |
| 21272 | 687 |
| 21273 | 623 |
| 21274 | 644 |
| 21275 | 752 |
| 21276 | 748 |
| 21277 | 653 |
| 21278 | 690 |
| 21279 | 745 |
| 21280 | 778 |
| 21281 | 786 |
| 21282 | 837 |
| 21283 | 907 |
| 21284 | 1031 |
| 21285 | 1033 |
| 21286 | 1081 |
| 21287 | 1155 |
| 21288 | 1211 |
| 21289 | 1248 |
| 21290 | 1304 |
| 21291 | 1343 |
| 21292 | 1351 |
| 21293 | 1358 |
| 21294 | 1395 |
| 21295 | 1408 |
| 21296 | 1400 |
| 21297 | 1382 |
| 21298 | 1389 |
| 21299 | 1406 |
| 21300 | 1418 |
| 21301 | 1432 |
| 21302 | 1410 |
| 21303 | 1380 |
| 21304 | 1317 |
| 21305 | 1250 |
| 21306 | 1190 |
| 21307 | 1124 |
| 21308 | 1052 |
| 21309 | 1000 |
| 21310 | 956 |
| 21311 | 915 |
| 21312 | 890 |
| 21313 | 862 |
| 21314 | 834 |
| 21315 | 814 |
| 21316 | 797 |
| 21317 | 782 |
| 21318 | 768 |
| 21319 | 760 |
| 21320 | 751 |
| 21321 | 742 |
| 21322 | 739 |
| 21323 | 740 |
| 21324 | 738 |
| 21325 | 734 |
| 21326 | 736 |
| 21327 | 740 |
| 21328 | 761 |
| 21329 | 766 |
| 21330 | 779 |
| 21331 | 799 |
| 21332 | 843 |
| 21333 | 855 |
| 21334 | 884 |
| 21335 | 907 |
| 21336 | 960 |
| 21337 | 997 |
| 21338 | 1016 |
| 21339 | 1039 |
| 21340 | 1089 |
| 21341 | 1104 |
| 21342 | 1119 |
| 21343 | 1118 |
| 21344 | 1120 |
| 21345 | 1102 |
| 21346 | 1063 |
| 21347 | 1045 |
| 21348 | 1011 |
| 21349 | 982 |
| 21350 | 949 |
| 21351 | 918 |
| 21352 | 932 |
| 21353 | 912 |
| 21354 | 870 |
| 21355 | 889 |
| 21356 | 961 |
| 21357 | 1027 |
| 21358 | 1061 |
| 21359 | 1072 |
| 21360 | 1027 |
| 21361 | 994 |
| 21362 | 958 |
| 21363 | 957 |
| 21364 | 941 |
| 21365 | 925 |
| 21366 | 883 |
| 21367 | 886 |
| 21368 | 917 |
| 21369 | 912 |
| 21370 | 936 |
| 21371 | 958 |
| 21372 | 962 |
| 21373 | 981 |
| 21374 | 981 |
| 21375 | 1004 |
| 21376 | 1014 |
| 21377 | 996 |
| 21378 | 995 |
| 21379 | 1027 |
| 21380 | 1104 |
| 21381 | 1153 |
| 21382 | 1219 |
| 21383 | 1286 |
| 21384 | 1347 |
| 21385 | 1407 |
| 21386 | 1464 |
| 21387 | 1476 |
| 21388 | 1476 |
| 21389 | 1472 |
| 21390 | 1475 |
| 21391 | 1479 |
| 21392 | 1480 |
| 21393 | 1464 |
| 21394 | 1452 |
| 21395 | 1458 |
| 21396 | 1460 |
| 21397 | 1453 |
| 21398 | 1424 |
| 21399 | 1401 |
| 21400 | 1322 |
| 21401 | 1254 |
| 21402 | 1188 |
| 21403 | 1120 |
| 21404 | 1037 |
| 21405 | 986 |
| 21406 | 940 |
| 21407 | 904 |
| 21408 | 879 |
| 21409 | 854 |
| 21410 | 830 |
| 21411 | 810 |
| 21412 | 791 |
| 21413 | 774 |
| 21414 | 764 |
| 21415 | 756 |
| 21416 | 750 |
| 21417 | 742 |
| 21418 | 737 |
| 21419 | 733 |
| 21420 | 732 |
| 21421 | 732 |
| 21422 | 733 |
| 21423 | 738 |
| 21424 | 755 |
| 21425 | 759 |
| 21426 | 779 |
| 21427 | 799 |
| 21428 | 834 |
| 21429 | 845 |
| 21430 | 878 |
| 21431 | 928 |
| 21432 | 991 |
| 21433 | 1015 |
| 21434 | 1052 |
| 21435 | 1088 |
| 21436 | 1143 |
| 21437 | 1177 |
| 21438 | 1200 |
| 21439 | 1220 |
| 21440 | 1229 |
| 21441 | 1231 |
| 21442 | 1217 |
| 21443 | 1203 |
| 21444 | 1171 |
| 21445 | 1175 |
| 21446 | 1163 |
| 21447 | 1151 |
| 21448 | 1117 |
| 21449 | 1104 |
| 21450 | 1103 |
| 21451 | 1115 |
| 21452 | 1102 |
| 21453 | 1063 |
| 21454 | 1086 |
| 21455 | 1088 |
| 21456 | 1031 |
| 21457 | 1005 |
| 21458 | 1009 |
| 21459 | 984 |
| 21460 | 941 |
| 21461 | 958 |
| 21462 | 837 |
| 21463 | 813 |
| 21464 | 788 |
| 21465 | 692 |
| 21466 | 749 |
| 21467 | 772 |
| 21468 | 747 |
| 21469 | 842 |
| 21470 | 870 |
| 21471 | 823 |
| 21472 | 844 |
| 21473 | 882 |
| 21474 | 977 |
| 21475 | 1027 |
| 21476 | 1028 |
| 21477 | 1055 |
| 21478 | 1125 |
| 21479 | 1187 |
| 21480 | 1202 |
| 21481 | 1238 |
| 21482 | 1273 |
| 21483 | 1311 |
| 21484 | 1330 |
| 21485 | 1333 |
| 21486 | 1362 |
| 21487 | 1397 |
| 21488 | 1406 |
| 21489 | 1413 |
| 21490 | 1423 |
| 21491 | 1443 |
| 21492 | 1468 |
| 21493 | 1461 |
| 21494 | 1444 |
| 21495 | 1411 |
| 21496 | 1349 |
| 21497 | 1282 |
| 21498 | 1221 |
| 21499 | 1154 |
| 21500 | 1087 |
| 21501 | 1029 |
| 21502 | 980 |
| 21503 | 941 |
| 21504 | 914 |
| 21505 | 883 |
| 21506 | 852 |
| 21507 | 826 |
| 21508 | 807 |
| 21509 | 789 |
| 21510 | 775 |
| 21511 | 764 |
| 21512 | 761 |
| 21513 | 754 |
| 21514 | 745 |
| 21515 | 741 |
| 21516 | 737 |
| 21517 | 730 |
| 21518 | 733 |
| 21519 | 739 |
| 21520 | 753 |
| 21521 | 762 |
| 21522 | 777 |
| 21523 | 796 |
| 21524 | 834 |
| 21525 | 850 |
| 21526 | 878 |
| 21527 | 914 |
| 21528 | 979 |
| 21529 | 1001 |
| 21530 | 1034 |
| 21531 | 1064 |
| 21532 | 1111 |
| 21533 | 1140 |
| 21534 | 1162 |
| 21535 | 1182 |
| 21536 | 1199 |
| 21537 | 1195 |
| 21538 | 1193 |
| 21539 | 1184 |
| 21540 | 1126 |
| 21541 | 1086 |
| 21542 | 1054 |
| 21543 | 1084 |
| 21544 | 1110 |
| 21545 | 1095 |
| 21546 | 1062 |
| 21547 | 1041 |
| 21548 | 1063 |
| 21549 | 1076 |
| 21550 | 1076 |
| 21551 | 1063 |
| 21552 | 1029 |
| 21553 | 957 |
| 21554 | 905 |
| 21555 | 902 |
| 21556 | 825 |
| 21557 | 789 |
| 21558 | 782 |
| 21559 | 815 |
| 21560 | 793 |
| 21561 | 785 |
| 21562 | 738 |
| 21563 | 765 |
| 21564 | 786 |
| 21565 | 825 |
| 21566 | 882 |
| 21567 | 985 |
| 21568 | 1053 |
| 21569 | 1081 |
| 21570 | 1105 |
| 21571 | 1130 |
| 21572 | 1127 |
| 21573 | 1144 |
| 21574 | 1207 |
| 21575 | 1261 |
| 21576 | 1321 |
| 21577 | 1369 |
| 21578 | 1418 |
| 21579 | 1445 |
| 21580 | 1445 |
| 21581 | 1420 |
| 21582 | 1408 |
| 21583 | 1422 |
| 21584 | 1430 |
| 21585 | 1421 |
| 21586 | 1417 |
| 21587 | 1427 |
| 21588 | 1435 |
| 21589 | 1436 |
| 21590 | 1415 |
| 21591 | 1383 |
| 21592 | 1321 |
| 21593 | 1266 |
| 21594 | 1211 |
| 21595 | 1158 |
| 21596 | 1100 |
| 21597 | 1047 |
| 21598 | 1001 |
| 21599 | 959 |
| 21600 | 927 |
| 21601 | 891 |
| 21602 | 864 |
| 21603 | 842 |
| 21604 | 823 |
| 21605 | 800 |
| 21606 | 785 |
| 21607 | 767 |
| 21608 | 761 |
| 21609 | 753 |
| 21610 | 745 |
| 21611 | 743 |
| 21612 | 739 |
| 21613 | 731 |
| 21614 | 729 |
| 21615 | 732 |
| 21616 | 744 |
| 21617 | 736 |
| 21618 | 735 |
| 21619 | 742 |
| 21620 | 757 |
| 21621 | 756 |
| 21622 | 774 |
| 21623 | 783 |
| 21624 | 829 |
| 21625 | 830 |
| 21626 | 839 |
| 21627 | 861 |
| 21628 | 902 |
| 21629 | 917 |
| 21630 | 937 |
| 21631 | 968 |
| 21632 | 991 |
| 21633 | 1018 |
| 21634 | 1030 |
| 21635 | 1045 |
| 21636 | 1063 |
| 21637 | 1037 |
| 21638 | 1059 |
| 21639 | 1035 |
| 21640 | 1060 |
| 21641 | 1059 |
| 21642 | 999 |
| 21643 | 960 |
| 21644 | 1023 |
| 21645 | 1041 |
| 21646 | 990 |
| 21647 | 987 |
| 21648 | 1011 |
| 21649 | 979 |
| 21650 | 908 |
| 21651 | 829 |
| 21652 | 687 |
| 21653 | 623 |
| 21654 | 689 |
| 21655 | 816 |
| 21656 | 775 |
| 21657 | 732 |
| 21658 | 687 |
| 21659 | 720 |
| 21660 | 801 |
| 21661 | 849 |
| 21662 | 833 |
| 21663 | 812 |
| 21664 | 817 |
| 21665 | 729 |
| 21666 | 784 |
| 21667 | 898 |
| 21668 | 956 |
| 21669 | 961 |
| 21670 | 993 |
| 21671 | 1025 |
| 21672 | 1107 |
| 21673 | 1167 |
| 21674 | 1222 |
| 21675 | 1266 |
| 21676 | 1293 |
| 21677 | 1333 |
| 21678 | 1361 |
| 21679 | 1378 |
| 21680 | 1380 |
| 21681 | 1373 |
| 21682 | 1366 |
| 21683 | 1388 |
| 21684 | 1390 |
| 21685 | 1381 |
| 21686 | 1358 |
| 21687 | 1331 |
| 21688 | 1280 |
| 21689 | 1229 |
| 21690 | 1180 |
| 21691 | 1132 |
| 21692 | 1077 |
| 21693 | 1038 |
| 21694 | 992 |
| 21695 | 952 |
| 21696 | 923 |
| 21697 | 894 |
| 21698 | 863 |
| 21699 | 839 |
| 21700 | 817 |
| 21701 | 790 |
| 21702 | 774 |
| 21703 | 759 |
| 21704 | 753 |
| 21705 | 736 |
| 21706 | 731 |
| 21707 | 728 |
| 21708 | 722 |
| 21709 | 713 |
| 21710 | 706 |
| 21711 | 704 |
| 21712 | 708 |
| 21713 | 707 |
| 21714 | 714 |
| 21715 | 720 |
| 21716 | 723 |
| 21717 | 716 |
| 21718 | 715 |
| 21719 | 728 |
| 21720 | 730 |
| 21721 | 715 |
| 21722 | 717 |
| 21723 | 731 |
| 21724 | 754 |
| 21725 | 773 |
| 21726 | 792 |
| 21727 | 801 |
| 21728 | 815 |
| 21729 | 829 |
| 21730 | 828 |
| 21731 | 853 |
| 21732 | 843 |
| 21733 | 846 |
| 21734 | 815 |
| 21735 | 815 |
| 21736 | 746 |
| 21737 | 701 |
| 21738 | 640 |
| 21739 | 634 |
| 21740 | 685 |
| 21741 | 714 |
| 21742 | 804 |
| 21743 | 825 |
| 21744 | 863 |
| 21745 | 770 |
| 21746 | 627 |
| 21747 | 681 |
| 21748 | 738 |
| 21749 | 766 |
| 21750 | 698 |
| 21751 | 677 |
| 21752 | 665 |
| 21753 | 646 |
| 21754 | 630 |
| 21755 | 637 |
| 21756 | 643 |
| 21757 | 677 |
| 21758 | 691 |
| 21759 | 699 |
| 21760 | 692 |
| 21761 | 715 |
| 21762 | 824 |
| 21763 | 923 |
| 21764 | 981 |
| 21765 | 1003 |
| 21766 | 1013 |
| 21767 | 1063 |
| 21768 | 1144 |
| 21769 | 1196 |
| 21770 | 1230 |
| 21771 | 1265 |
| 21772 | 1298 |
| 21773 | 1330 |
| 21774 | 1336 |
| 21775 | 1352 |
| 21776 | 1347 |
| 21777 | 1320 |
| 21778 | 1308 |
| 21779 | 1314 |
| 21780 | 1325 |
| 21781 | 1320 |
| 21782 | 1295 |
| 21783 | 1276 |
| 21784 | 1214 |
| 21785 | 1149 |
| 21786 | 1094 |
| 21787 | 1035 |
| 21788 | 964 |
| 21789 | 909 |
| 21790 | 870 |
| 21791 | 838 |
| 21792 | 811 |
| 21793 | 774 |
| 21794 | 745 |
| 21795 | 724 |
| 21796 | 711 |
| 21797 | 703 |
| 21798 | 691 |
| 21799 | 678 |
| 21800 | 678 |
| 21801 | 672 |
| 21802 | 671 |
| 21803 | 671 |
| 21804 | 670 |
| 21805 | 666 |
| 21806 | 665 |
| 21807 | 666 |
| 21808 | 693 |
| 21809 | 702 |
| 21810 | 717 |
| 21811 | 738 |
| 21812 | 786 |
| 21813 | 801 |
| 21814 | 830 |
| 21815 | 878 |
| 21816 | 948 |
| 21817 | 964 |
| 21818 | 988 |
| 21819 | 1030 |
| 21820 | 1093 |
| 21821 | 1130 |
| 21822 | 1143 |
| 21823 | 1156 |
| 21824 | 1196 |
| 21825 | 1189 |
| 21826 | 1195 |
| 21827 | 1172 |
| 21828 | 1110 |
| 21829 | 1102 |
| 21830 | 1131 |
| 21831 | 1104 |
| 21832 | 1106 |
| 21833 | 1101 |
| 21834 | 1138 |
| 21835 | 1177 |
| 21836 | 1165 |
| 21837 | 1207 |
| 21838 | 1255 |
| 21839 | 1168 |
| 21840 | 1045 |
| 21841 | 893 |
| 21842 | 848 |
| 21843 | 820 |
| 21844 | 853 |
| 21845 | 867 |
| 21846 | 931 |
| 21847 | 949 |
| 21848 | 879 |
| 21849 | 899 |
| 21850 | 946 |
| 21851 | 949 |
| 21852 | 985 |
| 21853 | 902 |
| 21854 | 935 |
| 21855 | 836 |
| 21856 | 934 |
| 21857 | 994 |
| 21858 | 1058 |
| 21859 | 1085 |
| 21860 | 1074 |
| 21861 | 1107 |
| 21862 | 1170 |
| 21863 | 1255 |
| 21864 | 1311 |
| 21865 | 1379 |
| 21866 | 1421 |
| 21867 | 1429 |
| 21868 | 1447 |
| 21869 | 1464 |
| 21870 | 1471 |
| 21871 | 1481 |
| 21872 | 1492 |
| 21873 | 1470 |
| 21874 | 1472 |
| 21875 | 1475 |
| 21876 | 1477 |
| 21877 | 1465 |
| 21878 | 1426 |
| 21879 | 1386 |
| 21880 | 1317 |
| 21881 | 1249 |
| 21882 | 1195 |
| 21883 | 1128 |
| 21884 | 1059 |
| 21885 | 1005 |
| 21886 | 952 |
| 21887 | 903 |
| 21888 | 877 |
| 21889 | 851 |
| 21890 | 820 |
| 21891 | 801 |
| 21892 | 785 |
| 21893 | 772 |
| 21894 | 757 |
| 21895 | 745 |
| 21896 | 743 |
| 21897 | 733 |
| 21898 | 732 |
| 21899 | 726 |
| 21900 | 726 |
| 21901 | 722 |
| 21902 | 730 |
| 21903 | 733 |
| 21904 | 750 |
| 21905 | 758 |
| 21906 | 772 |
| 21907 | 787 |
| 21908 | 830 |
| 21909 | 849 |
| 21910 | 877 |
| 21911 | 927 |
| 21912 | 984 |
| 21913 | 1023 |
| 21914 | 1026 |
| 21915 | 1050 |
| 21916 | 1121 |
| 21917 | 1146 |
| 21918 | 1169 |
| 21919 | 1184 |
| 21920 | 1215 |
| 21921 | 1221 |
| 21922 | 1236 |
| 21923 | 1222 |
| 21924 | 1180 |
| 21925 | 1158 |
| 21926 | 1148 |
| 21927 | 1148 |
| 21928 | 1124 |
| 21929 | 1068 |
| 21930 | 1049 |
| 21931 | 1039 |
| 21932 | 1057 |
| 21933 | 1085 |
| 21934 | 1070 |
| 21935 | 1085 |
| 21936 | 1115 |
| 21937 | 1073 |
| 21938 | 1021 |
| 21939 | 970 |
| 21940 | 902 |
| 21941 | 884 |
| 21942 | 868 |
| 21943 | 861 |
| 21944 | 820 |
| 21945 | 812 |
| 21946 | 864 |
| 21947 | 970 |
| 21948 | 1003 |
| 21949 | 877 |
| 21950 | 891 |
| 21951 | 964 |
| 21952 | 1005 |
| 21953 | 1008 |
| 21954 | 1028 |
| 21955 | 1085 |
| 21956 | 1192 |
| 21957 | 1187 |
| 21958 | 1248 |
| 21959 | 1338 |
| 21960 | 1400 |
| 21961 | 1423 |
| 21962 | 1453 |
| 21963 | 1467 |
| 21964 | 1457 |
| 21965 | 1458 |
| 21966 | 1477 |
| 21967 | 1491 |
| 21968 | 1496 |
| 21969 | 1481 |
| 21970 | 1496 |
| 21971 | 1504 |
| 21972 | 1494 |
| 21973 | 1484 |
| 21974 | 1440 |
| 21975 | 1407 |
| 21976 | 1337 |
| 21977 | 1264 |
| 21978 | 1200 |
| 21979 | 1135 |
| 21980 | 1063 |
| 21981 | 1010 |
| 21982 | 963 |
| 21983 | 922 |
| 21984 | 898 |
| 21985 | 874 |
| 21986 | 840 |
| 21987 | 815 |
| 21988 | 799 |
| 21989 | 783 |
| 21990 | 767 |
| 21991 | 757 |
| 21992 | 750 |
| 21993 | 742 |
| 21994 | 740 |
| 21995 | 740 |
| 21996 | 738 |
| 21997 | 733 |
| 21998 | 734 |
| 21999 | 740 |
| 22000 | 762 |
| 22001 | 767 |
| 22002 | 779 |
| 22003 | 799 |
| 22004 | 845 |
| 22005 | 860 |
| 22006 | 891 |
| 22007 | 934 |
| 22008 | 998 |
| 22009 | 1021 |
| 22010 | 1047 |
| 22011 | 1077 |
| 22012 | 1138 |
| 22013 | 1153 |
| 22014 | 1176 |
| 22015 | 1183 |
| 22016 | 1185 |
| 22017 | 1171 |
| 22018 | 1148 |
| 22019 | 1132 |
| 22020 | 1088 |
| 22021 | 1049 |
| 22022 | 1010 |
| 22023 | 977 |
| 22024 | 989 |
| 22025 | 953 |
| 22026 | 905 |
| 22027 | 915 |
| 22028 | 966 |
| 22029 | 1027 |
| 22030 | 1060 |
| 22031 | 1054 |
| 22032 | 1014 |
| 22033 | 991 |
| 22034 | 953 |
| 22035 | 921 |
| 22036 | 926 |
| 22037 | 902 |
| 22038 | 831 |
| 22039 | 808 |
| 22040 | 823 |
| 22041 | 818 |
| 22042 | 815 |
| 22043 | 842 |
| 22044 | 860 |
| 22045 | 894 |
| 22046 | 873 |
| 22047 | 920 |
| 22048 | 930 |
| 22049 | 914 |
| 22050 | 918 |
| 22051 | 962 |
| 22052 | 1052 |
| 22053 | 1120 |
| 22054 | 1201 |
| 22055 | 1278 |
| 22056 | 1339 |
| 22057 | 1405 |
| 22058 | 1457 |
| 22059 | 1482 |
| 22060 | 1489 |
| 22061 | 1494 |
| 22062 | 1507 |
| 22063 | 1521 |
| 22064 | 1526 |
| 22065 | 1517 |
| 22066 | 1522 |
| 22067 | 1543 |
| 22068 | 1539 |
| 22069 | 1504 |
| 22070 | 1459 |
| 22071 | 1426 |
| 22072 | 1348 |
| 22073 | 1278 |
| 22074 | 1203 |
| 22075 | 1135 |
| 22076 | 1057 |
| 22077 | 1002 |
| 22078 | 953 |
| 22079 | 918 |
| 22080 | 891 |
| 22081 | 863 |
| 22082 | 836 |
| 22083 | 816 |
| 22084 | 796 |
| 22085 | 778 |
| 22086 | 766 |
| 22087 | 757 |
| 22088 | 749 |
| 22089 | 742 |
| 22090 | 736 |
| 22091 | 733 |
| 22092 | 732 |
| 22093 | 734 |
| 22094 | 734 |
| 22095 | 740 |
| 22096 | 756 |
| 22097 | 760 |
| 22098 | 780 |
| 22099 | 800 |
| 22100 | 840 |
| 22101 | 849 |
| 22102 | 890 |
| 22103 | 949 |
| 22104 | 1027 |
| 22105 | 1033 |
| 22106 | 1061 |
| 22107 | 1096 |
| 22108 | 1146 |
| 22109 | 1170 |
| 22110 | 1176 |
| 22111 | 1175 |
| 22112 | 1176 |
| 22113 | 1174 |
| 22114 | 1168 |
| 22115 | 1154 |
| 22116 | 1109 |
| 22117 | 1089 |
| 22118 | 1070 |
| 22119 | 1055 |
| 22120 | 1019 |
| 22121 | 973 |
| 22122 | 962 |
| 22123 | 954 |
| 22124 | 912 |
| 22125 | 878 |
| 22126 | 897 |
| 22127 | 885 |
| 22128 | 857 |
| 22129 | 894 |
| 22130 | 922 |
| 22131 | 931 |
| 22132 | 956 |
| 22133 | 971 |
| 22134 | 899 |
| 22135 | 870 |
| 22136 | 812 |
| 22137 | 720 |
| 22138 | 722 |
| 22139 | 766 |
| 22140 | 783 |
| 22141 | 850 |
| 22142 | 899 |
| 22143 | 855 |
| 22144 | 889 |
| 22145 | 908 |
| 22146 | 992 |
| 22147 | 1066 |
| 22148 | 1106 |
| 22149 | 1115 |
| 22150 | 1179 |
| 22151 | 1240 |
| 22152 | 1262 |
| 22153 | 1304 |
| 22154 | 1342 |
| 22155 | 1382 |
| 22156 | 1404 |
| 22157 | 1402 |
| 22158 | 1431 |
| 22159 | 1459 |
| 22160 | 1466 |
| 22161 | 1469 |
| 22162 | 1499 |
| 22163 | 1518 |
| 22164 | 1534 |
| 22165 | 1500 |
| 22166 | 1465 |
| 22167 | 1423 |
| 22168 | 1356 |
| 22169 | 1285 |
| 22170 | 1226 |
| 22171 | 1158 |
| 22172 | 1088 |
| 22173 | 1028 |
| 22174 | 979 |
| 22175 | 938 |
| 22176 | 906 |
| 22177 | 874 |
| 22178 | 845 |
| 22179 | 818 |
| 22180 | 800 |
| 22181 | 782 |
| 22182 | 771 |
| 22183 | 760 |
| 22184 | 755 |
| 22185 | 748 |
| 22186 | 740 |
| 22187 | 736 |
| 22188 | 732 |
| 22189 | 725 |
| 22190 | 728 |
| 22191 | 734 |
| 22192 | 748 |
| 22193 | 758 |
| 22194 | 773 |
| 22195 | 795 |
| 22196 | 834 |
| 22197 | 848 |
| 22198 | 884 |
| 22199 | 938 |
| 22200 | 1013 |
| 22201 | 1033 |
| 22202 | 1054 |
| 22203 | 1094 |
| 22204 | 1156 |
| 22205 | 1189 |
| 22206 | 1223 |
| 22207 | 1243 |
| 22208 | 1274 |
| 22209 | 1292 |
| 22210 | 1314 |
| 22211 | 1324 |
| 22212 | 1286 |
| 22213 | 1260 |
| 22214 | 1221 |
| 22215 | 1230 |
| 22216 | 1231 |
| 22217 | 1209 |
| 22218 | 1192 |
| 22219 | 1187 |
| 22220 | 1224 |
| 22221 | 1257 |
| 22222 | 1202 |
| 22223 | 1135 |
| 22224 | 1059 |
| 22225 | 992 |
| 22226 | 911 |
| 22227 | 884 |
| 22228 | 825 |
| 22229 | 805 |
| 22230 | 803 |
| 22231 | 832 |
| 22232 | 792 |
| 22233 | 779 |
| 22234 | 733 |
| 22235 | 760 |
| 22236 | 762 |
| 22237 | 824 |
| 22238 | 890 |
| 22239 | 962 |
| 22240 | 1003 |
| 22241 | 1015 |
| 22242 | 1040 |
| 22243 | 1084 |
| 22244 | 1069 |
| 22245 | 1084 |
| 22246 | 1132 |
| 22247 | 1206 |
| 22248 | 1293 |
| 22249 | 1373 |
| 22250 | 1424 |
| 22251 | 1440 |
| 22252 | 1443 |
| 22253 | 1437 |
| 22254 | 1443 |
| 22255 | 1462 |
| 22256 | 1480 |
| 22257 | 1479 |
| 22258 | 1494 |
| 22259 | 1509 |
| 22260 | 1509 |
| 22261 | 1484 |
| 22262 | 1443 |
| 22263 | 1405 |
| 22264 | 1341 |
| 22265 | 1283 |
| 22266 | 1226 |
| 22267 | 1168 |
| 22268 | 1108 |
| 22269 | 1057 |
| 22270 | 1011 |
| 22271 | 969 |
| 22272 | 932 |
| 22273 | 900 |
| 22274 | 873 |
| 22275 | 851 |
| 22276 | 834 |
| 22277 | 814 |
| 22278 | 794 |
| 22279 | 777 |
| 22280 | 770 |
| 22281 | 758 |
| 22282 | 750 |
| 22283 | 748 |
| 22284 | 743 |
| 22285 | 737 |
| 22286 | 735 |
| 22287 | 742 |
| 22288 | 753 |
| 22289 | 748 |
| 22290 | 749 |
| 22291 | 756 |
| 22292 | 774 |
| 22293 | 776 |
| 22294 | 792 |
| 22295 | 821 |
| 22296 | 875 |
| 22297 | 866 |
| 22298 | 877 |
| 22299 | 908 |
| 22300 | 947 |
| 22301 | 968 |
| 22302 | 992 |
| 22303 | 1010 |
| 22304 | 1027 |
| 22305 | 1068 |
| 22306 | 1092 |
| 22307 | 1107 |
| 22308 | 1090 |
| 22309 | 1082 |
| 22310 | 1085 |
| 22311 | 1021 |
| 22312 | 1036 |
| 22313 | 1009 |
| 22314 | 1005 |
| 22315 | 954 |
| 22316 | 916 |
| 22317 | 880 |
| 22318 | 850 |
| 22319 | 906 |
| 22320 | 914 |
| 22321 | 897 |
| 22322 | 818 |
| 22323 | 717 |
| 22324 | 621 |
| 22325 | 663 |
| 22326 | 791 |
| 22327 | 967 |
| 22328 | 974 |
| 22329 | 866 |
| 22330 | 709 |
| 22331 | 766 |
| 22332 | 881 |
| 22333 | 911 |
| 22334 | 926 |
| 22335 | 980 |
| 22336 | 932 |
| 22337 | 822 |
| 22338 | 855 |
| 22339 | 962 |
| 22340 | 1019 |
| 22341 | 1046 |
| 22342 | 1099 |
| 22343 | 1138 |
| 22344 | 1207 |
| 22345 | 1258 |
| 22346 | 1319 |
| 22347 | 1362 |
| 22348 | 1382 |
| 22349 | 1414 |
| 22350 | 1427 |
| 22351 | 1442 |
| 22352 | 1450 |
| 22353 | 1451 |
| 22354 | 1446 |
| 22355 | 1461 |
| 22356 | 1448 |
| 22357 | 1411 |
| 22358 | 1376 |
| 22359 | 1345 |
| 22360 | 1292 |
| 22361 | 1241 |
| 22362 | 1190 |
| 22363 | 1144 |
| 22364 | 1089 |
| 22365 | 1046 |
| 22366 | 1001 |
| 22367 | 959 |
| 22368 | 932 |
| 22369 | 901 |
| 22370 | 867 |
| 22371 | 841 |
| 22372 | 820 |
| 22373 | 795 |
| 22374 | 776 |
| 22375 | 757 |
| 22376 | 750 |
| 22377 | 738 |
| 22378 | 729 |
| 22379 | 725 |
| 22380 | 726 |
| 22381 | 721 |
| 22382 | 717 |
| 22383 | 715 |
| 22384 | 716 |
| 22385 | 710 |
| 22386 | 714 |
| 22387 | 715 |
| 22388 | 720 |
| 22389 | 716 |
| 22390 | 720 |
| 22391 | 731 |
| 22392 | 750 |
| 22393 | 737 |
| 22394 | 738 |
| 22395 | 744 |
| 22396 | 775 |
| 22397 | 795 |
| 22398 | 815 |
| 22399 | 834 |
| 22400 | 858 |
| 22401 | 894 |
| 22402 | 917 |
| 22403 | 966 |
| 22404 | 976 |
| 22405 | 954 |
| 22406 | 906 |
| 22407 | 854 |
| 22408 | 836 |
| 22409 | 852 |
| 22410 | 835 |
| 22411 | 832 |
| 22412 | 854 |
| 22413 | 938 |
| 22414 | 1031 |
| 22415 | 1034 |
| 22416 | 1093 |
| 22417 | 935 |
| 22418 | 780 |
| 22419 | 773 |
| 22420 | 802 |
| 22421 | 870 |
| 22422 | 851 |
| 22423 | 791 |
| 22424 | 758 |
| 22425 | 731 |
| 22426 | 674 |
| 22427 | 600 |
| 22428 | 628 |
| 22429 | 653 |
| 22430 | 707 |
| 22431 | 697 |
| 22432 | 697 |
| 22433 | 742 |
| 22434 | 845 |
| 22435 | 911 |
| 22436 | 940 |
| 22437 | 980 |
| 22438 | 978 |
| 22439 | 1046 |
| 22440 | 1097 |
| 22441 | 1108 |
| 22442 | 1165 |
| 22443 | 1228 |
| 22444 | 1276 |
| 22445 | 1308 |
| 22446 | 1327 |
| 22447 | 1340 |
| 22448 | 1355 |
| 22449 | 1358 |
| 22450 | 1373 |
| 22451 | 1384 |
| 22452 | 1376 |
| 22453 | 1351 |
| 22454 | 1321 |
| 22455 | 1304 |
| 22456 | 1236 |
| 22457 | 1168 |
| 22458 | 1112 |
| 22459 | 1051 |
| 22460 | 990 |
| 22461 | 940 |
| 22462 | 894 |
| 22463 | 857 |
| 22464 | 827 |
| 22465 | 796 |
| 22466 | 770 |
| 22467 | 751 |
| 22468 | 728 |
| 22469 | 710 |
| 22470 | 697 |
| 22471 | 686 |
| 22472 | 680 |
| 22473 | 671 |
| 22474 | 668 |
| 22475 | 669 |
| 22476 | 669 |
| 22477 | 664 |
| 22478 | 664 |
| 22479 | 669 |
| 22480 | 696 |
| 22481 | 707 |
| 22482 | 726 |
| 22483 | 750 |
| 22484 | 800 |
| 22485 | 817 |
| 22486 | 848 |
| 22487 | 909 |
| 22488 | 997 |
| 22489 | 1019 |
| 22490 | 1036 |
| 22491 | 1081 |
| 22492 | 1147 |
| 22493 | 1182 |
| 22494 | 1193 |
| 22495 | 1216 |
| 22496 | 1274 |
| 22497 | 1280 |
| 22498 | 1294 |
| 22499 | 1272 |
| 22500 | 1191 |
| 22501 | 1157 |
| 22502 | 1201 |
| 22503 | 1217 |
| 22504 | 1215 |
| 22505 | 1245 |
| 22506 | 1302 |
| 22507 | 1327 |
| 22508 | 1337 |
| 22509 | 1426 |
| 22510 | 1493 |
| 22511 | 1442 |
| 22512 | 1314 |
| 22513 | 1119 |
| 22514 | 1005 |
| 22515 | 963 |
| 22516 | 1027 |
| 22517 | 1072 |
| 22518 | 1131 |
| 22519 | 1176 |
| 22520 | 1140 |
| 22521 | 1159 |
| 22522 | 1160 |
| 22523 | 1118 |
| 22524 | 1117 |
| 22525 | 1038 |
| 22526 | 1022 |
| 22527 | 981 |
| 22528 | 1089 |
| 22529 | 1180 |
| 22530 | 1207 |
| 22531 | 1227 |
| 22532 | 1212 |
| 22533 | 1200 |
| 22534 | 1252 |
| 22535 | 1338 |
| 22536 | 1398 |
| 22537 | 1462 |
| 22538 | 1512 |
| 22539 | 1543 |
| 22540 | 1565 |
| 22541 | 1575 |
| 22542 | 1575 |
| 22543 | 1574 |
| 22544 | 1587 |
| 22545 | 1573 |
| 22546 | 1585 |
| 22547 | 1575 |
| 22548 | 1550 |
| 22549 | 1501 |
| 22550 | 1456 |
| 22551 | 1419 |
| 22552 | 1343 |
| 22553 | 1278 |
| 22554 | 1209 |
| 22555 | 1138 |
| 22556 | 1070 |
| 22557 | 1015 |
| 22558 | 963 |
| 22559 | 914 |
| 22560 | 891 |
| 22561 | 868 |
| 22562 | 836 |
| 22563 | 818 |
| 22564 | 800 |
| 22565 | 785 |
| 22566 | 768 |
| 22567 | 754 |
| 22568 | 753 |
| 22569 | 745 |
| 22570 | 744 |
| 22571 | 742 |
| 22572 | 742 |
| 22573 | 741 |
| 22574 | 744 |
| 22575 | 746 |
| 22576 | 765 |
| 22577 | 769 |
| 22578 | 787 |
| 22579 | 808 |
| 22580 | 853 |
| 22581 | 874 |
| 22582 | 908 |
| 22583 | 965 |
| 22584 | 1040 |
| 22585 | 1092 |
| 22586 | 1090 |
| 22587 | 1120 |
| 22588 | 1194 |
| 22589 | 1231 |
| 22590 | 1253 |
| 22591 | 1274 |
| 22592 | 1298 |
| 22593 | 1311 |
| 22594 | 1324 |
| 22595 | 1309 |
| 22596 | 1289 |
| 22597 | 1264 |
| 22598 | 1235 |
| 22599 | 1235 |
| 22600 | 1227 |
| 22601 | 1195 |
| 22602 | 1158 |
| 22603 | 1158 |
| 22604 | 1204 |
| 22605 | 1244 |
| 22606 | 1273 |
| 22607 | 1320 |
| 22608 | 1321 |
| 22609 | 1284 |
| 22610 | 1259 |
| 22611 | 1241 |
| 22612 | 1172 |
| 22613 | 1168 |
| 22614 | 1147 |
| 22615 | 1141 |
| 22616 | 1121 |
| 22617 | 1131 |
| 22618 | 1156 |
| 22619 | 1211 |
| 22620 | 1233 |
| 22621 | 1130 |
| 22622 | 1086 |
| 22623 | 1140 |
| 22624 | 1192 |
| 22625 | 1199 |
| 22626 | 1195 |
| 22627 | 1238 |
| 22628 | 1321 |
| 22629 | 1360 |
| 22630 | 1424 |
| 22631 | 1494 |
| 22632 | 1541 |
| 22633 | 1567 |
| 22634 | 1587 |
| 22635 | 1592 |
| 22636 | 1575 |
| 22637 | 1567 |
| 22638 | 1569 |
| 22639 | 1575 |
| 22640 | 1580 |
| 22641 | 1577 |
| 22642 | 1603 |
| 22643 | 1598 |
| 22644 | 1562 |
| 22645 | 1513 |
| 22646 | 1470 |
| 22647 | 1428 |
| 22648 | 1356 |
| 22649 | 1278 |
| 22650 | 1210 |
| 22651 | 1143 |
| 22652 | 1073 |
| 22653 | 1017 |
| 22654 | 968 |
| 22655 | 926 |
| 22656 | 903 |
| 22657 | 871 |
| 22658 | 839 |
| 22659 | 815 |
| 22660 | 798 |
| 22661 | 778 |
| 22662 | 761 |
| 22663 | 751 |
| 22664 | 745 |
| 22665 | 735 |
| 22666 | 731 |
| 22667 | 730 |
| 22668 | 730 |
| 22669 | 721 |
| 22670 | 722 |
| 22671 | 732 |
| 22672 | 759 |
| 22673 | 765 |
| 22674 | 781 |
| 22675 | 799 |
| 22676 | 847 |
| 22677 | 865 |
| 22678 | 896 |
| 22679 | 947 |
| 22680 | 1026 |
| 22681 | 1053 |
| 22682 | 1069 |
| 22683 | 1106 |
| 22684 | 1164 |
| 22685 | 1185 |
| 22686 | 1204 |
| 22687 | 1208 |
| 22688 | 1233 |
| 22689 | 1214 |
| 22690 | 1193 |
| 22691 | 1181 |
| 22692 | 1146 |
| 22693 | 1128 |
| 22694 | 1101 |
| 22695 | 1077 |
| 22696 | 1060 |
| 22697 | 1013 |
| 22698 | 996 |
| 22699 | 992 |
| 22700 | 1012 |
| 22701 | 1036 |
| 22702 | 1051 |
| 22703 | 1042 |
| 22704 | 1012 |
| 22705 | 975 |
| 22706 | 926 |
| 22707 | 877 |
| 22708 | 887 |
| 22709 | 872 |
| 22710 | 834 |
| 22711 | 808 |
| 22712 | 803 |
| 22713 | 829 |
| 22714 | 828 |
| 22715 | 811 |
| 22716 | 813 |
| 22717 | 860 |
| 22718 | 857 |
| 22719 | 866 |
| 22720 | 875 |
| 22721 | 932 |
| 22722 | 974 |
| 22723 | 1003 |
| 22724 | 1056 |
| 22725 | 1108 |
| 22726 | 1168 |
| 22727 | 1228 |
| 22728 | 1285 |
| 22729 | 1347 |
| 22730 | 1412 |
| 22731 | 1457 |
| 22732 | 1486 |
| 22733 | 1499 |
| 22734 | 1515 |
| 22735 | 1533 |
| 22736 | 1543 |
| 22737 | 1567 |
| 22738 | 1576 |
| 22739 | 1602 |
| 22740 | 1574 |
| 22741 | 1523 |
| 22742 | 1479 |
| 22743 | 1449 |
| 22744 | 1371 |
| 22745 | 1299 |
| 22746 | 1225 |
| 22747 | 1157 |
| 22748 | 1080 |
| 22749 | 1018 |
| 22750 | 967 |
| 22751 | 926 |
| 22752 | 902 |
| 22753 | 873 |
| 22754 | 845 |
| 22755 | 823 |
| 22756 | 803 |
| 22757 | 782 |
| 22758 | 771 |
| 22759 | 759 |
| 22760 | 752 |
| 22761 | 745 |
| 22762 | 737 |
| 22763 | 737 |
| 22764 | 733 |
| 22765 | 731 |
| 22766 | 730 |
| 22767 | 734 |
| 22768 | 751 |
| 22769 | 758 |
| 22770 | 778 |
| 22771 | 797 |
| 22772 | 843 |
| 22773 | 857 |
| 22774 | 898 |
| 22775 | 954 |
| 22776 | 1040 |
| 22777 | 1065 |
| 22778 | 1093 |
| 22779 | 1119 |
| 22780 | 1172 |
| 22781 | 1201 |
| 22782 | 1201 |
| 22783 | 1202 |
| 22784 | 1214 |
| 22785 | 1212 |
| 22786 | 1220 |
| 22787 | 1221 |
| 22788 | 1183 |
| 22789 | 1156 |
| 22790 | 1129 |
| 22791 | 1110 |
| 22792 | 1091 |
| 22793 | 1037 |
| 22794 | 1009 |
| 22795 | 999 |
| 22796 | 982 |
| 22797 | 993 |
| 22798 | 1004 |
| 22799 | 1005 |
| 22800 | 990 |
| 22801 | 964 |
| 22802 | 942 |
| 22803 | 947 |
| 22804 | 959 |
| 22805 | 954 |
| 22806 | 940 |
| 22807 | 921 |
| 22808 | 886 |
| 22809 | 826 |
| 22810 | 778 |
| 22811 | 802 |
| 22812 | 805 |
| 22813 | 793 |
| 22814 | 779 |
| 22815 | 789 |
| 22816 | 880 |
| 22817 | 920 |
| 22818 | 971 |
| 22819 | 1007 |
| 22820 | 1069 |
| 22821 | 1074 |
| 22822 | 1138 |
| 22823 | 1193 |
| 22824 | 1238 |
| 22825 | 1324 |
| 22826 | 1365 |
| 22827 | 1418 |
| 22828 | 1455 |
| 22829 | 1462 |
| 22830 | 1477 |
| 22831 | 1504 |
| 22832 | 1516 |
| 22833 | 1535 |
| 22834 | 1569 |
| 22835 | 1579 |
| 22836 | 1567 |
| 22837 | 1517 |
| 22838 | 1473 |
| 22839 | 1431 |
| 22840 | 1359 |
| 22841 | 1283 |
| 22842 | 1216 |
| 22843 | 1156 |
| 22844 | 1089 |
| 22845 | 1029 |
| 22846 | 976 |
| 22847 | 933 |
| 22848 | 905 |
| 22849 | 872 |
| 22850 | 845 |
| 22851 | 822 |
| 22852 | 802 |
| 22853 | 783 |
| 22854 | 771 |
| 22855 | 758 |
| 22856 | 749 |
| 22857 | 740 |
| 22858 | 734 |
| 22859 | 733 |
| 22860 | 728 |
| 22861 | 725 |
| 22862 | 726 |
| 22863 | 729 |
| 22864 | 748 |
| 22865 | 759 |
| 22866 | 776 |
| 22867 | 796 |
| 22868 | 838 |
| 22869 | 857 |
| 22870 | 894 |
| 22871 | 950 |
| 22872 | 1037 |
| 22873 | 1071 |
| 22874 | 1078 |
| 22875 | 1121 |
| 22876 | 1187 |
| 22877 | 1215 |
| 22878 | 1236 |
| 22879 | 1245 |
| 22880 | 1269 |
| 22881 | 1278 |
| 22882 | 1278 |
| 22883 | 1263 |
| 22884 | 1218 |
| 22885 | 1178 |
| 22886 | 1156 |
| 22887 | 1129 |
| 22888 | 1095 |
| 22889 | 1058 |
| 22890 | 1020 |
| 22891 | 1013 |
| 22892 | 1037 |
| 22893 | 1077 |
| 22894 | 1047 |
| 22895 | 1001 |
| 22896 | 953 |
| 22897 | 933 |
| 22898 | 875 |
| 22899 | 872 |
| 22900 | 852 |
| 22901 | 822 |
| 22902 | 769 |
| 22903 | 803 |
| 22904 | 781 |
| 22905 | 743 |
| 22906 | 681 |
| 22907 | 661 |
| 22908 | 657 |
| 22909 | 710 |
| 22910 | 772 |
| 22911 | 852 |
| 22912 | 901 |
| 22913 | 925 |
| 22914 | 960 |
| 22915 | 1003 |
| 22916 | 1011 |
| 22917 | 1048 |
| 22918 | 1102 |
| 22919 | 1174 |
| 22920 | 1268 |
| 22921 | 1351 |
| 22922 | 1413 |
| 22923 | 1451 |
| 22924 | 1463 |
| 22925 | 1462 |
| 22926 | 1466 |
| 22927 | 1494 |
| 22928 | 1518 |
| 22929 | 1544 |
| 22930 | 1571 |
| 22931 | 1580 |
| 22932 | 1542 |
| 22933 | 1500 |
| 22934 | 1460 |
| 22935 | 1415 |
| 22936 | 1350 |
| 22937 | 1298 |
| 22938 | 1241 |
| 22939 | 1181 |
| 22940 | 1120 |
| 22941 | 1068 |
| 22942 | 1023 |
| 22943 | 982 |
| 22944 | 945 |
| 22945 | 912 |
| 22946 | 885 |
| 22947 | 864 |
| 22948 | 844 |
| 22949 | 822 |
| 22950 | 803 |
| 22951 | 790 |
| 22952 | 783 |
| 22953 | 770 |
| 22954 | 760 |
| 22955 | 755 |
| 22956 | 753 |
| 22957 | 744 |
| 22958 | 745 |
| 22959 | 749 |
| 22960 | 761 |
| 22961 | 755 |
| 22962 | 759 |
| 22963 | 766 |
| 22964 | 783 |
| 22965 | 784 |
| 22966 | 800 |
| 22967 | 828 |
| 22968 | 893 |
| 22969 | 901 |
| 22970 | 901 |
| 22971 | 927 |
| 22972 | 967 |
| 22973 | 993 |
| 22974 | 1019 |
| 22975 | 1033 |
| 22976 | 1051 |
| 22977 | 1100 |
| 22978 | 1128 |
| 22979 | 1132 |
| 22980 | 1124 |
| 22981 | 1131 |
| 22982 | 1137 |
| 22983 | 1095 |
| 22984 | 1050 |
| 22985 | 988 |
| 22986 | 976 |
| 22987 | 919 |
| 22988 | 868 |
| 22989 | 849 |
| 22990 | 864 |
| 22991 | 876 |
| 22992 | 861 |
| 22993 | 818 |
| 22994 | 752 |
| 22995 | 696 |
| 22996 | 681 |
| 22997 | 759 |
| 22998 | 839 |
| 22999 | 926 |
| 23000 | 990 |
| 23001 | 955 |
| 23002 | 845 |
| 23003 | 921 |
| 23004 | 992 |
| 23005 | 992 |
| 23006 | 1021 |
| 23007 | 1048 |
| 23008 | 963 |
| 23009 | 876 |
| 23010 | 894 |
| 23011 | 946 |
| 23012 | 984 |
| 23013 | 1005 |
| 23014 | 1077 |
| 23015 | 1154 |
| 23016 | 1225 |
| 23017 | 1289 |
| 23018 | 1366 |
| 23019 | 1421 |
| 23020 | 1445 |
| 23021 | 1466 |
| 23022 | 1479 |
| 23023 | 1488 |
| 23024 | 1495 |
| 23025 | 1509 |
| 23026 | 1503 |
| 23027 | 1503 |
| 23028 | 1464 |
| 23029 | 1422 |
| 23030 | 1386 |
| 23031 | 1354 |
| 23032 | 1301 |
| 23033 | 1253 |
| 23034 | 1206 |
| 23035 | 1164 |
| 23036 | 1110 |
| 23037 | 1061 |
| 23038 | 1015 |
| 23039 | 970 |
| 23040 | 943 |
| 23041 | 909 |
| 23042 | 875 |
| 23043 | 847 |
| 23044 | 826 |
| 23045 | 801 |
| 23046 | 784 |
| 23047 | 768 |
| 23048 | 758 |
| 23049 | 747 |
| 23050 | 736 |
| 23051 | 731 |
| 23052 | 732 |
| 23053 | 728 |
| 23054 | 721 |
| 23055 | 722 |
| 23056 | 725 |
| 23057 | 722 |
| 23058 | 725 |
| 23059 | 729 |
| 23060 | 738 |
| 23061 | 733 |
| 23062 | 740 |
| 23063 | 751 |
| 23064 | 776 |
| 23065 | 771 |
| 23066 | 773 |
| 23067 | 770 |
| 23068 | 801 |
| 23069 | 818 |
| 23070 | 835 |
| 23071 | 859 |
| 23072 | 876 |
| 23073 | 891 |
| 23074 | 917 |
| 23075 | 969 |
| 23076 | 991 |
| 23077 | 968 |
| 23078 | 945 |
| 23079 | 920 |
| 23080 | 923 |
| 23081 | 957 |
| 23082 | 936 |
| 23083 | 952 |
| 23084 | 977 |
| 23085 | 1075 |
| 23086 | 1121 |
| 23087 | 1102 |
| 23088 | 1073 |
| 23089 | 854 |
| 23090 | 717 |
| 23091 | 744 |
| 23092 | 806 |
| 23093 | 842 |
| 23094 | 835 |
| 23095 | 733 |
| 23096 | 718 |
| 23097 | 695 |
| 23098 | 639 |
| 23099 | 560 |
| 23100 | 577 |
| 23101 | 621 |
| 23102 | 670 |
| 23103 | 680 |
| 23104 | 716 |
| 23105 | 786 |
| 23106 | 878 |
| 23107 | 941 |
| 23108 | 967 |
| 23109 | 997 |
| 23110 | 989 |
| 23111 | 1037 |
| 23112 | 1094 |
| 23113 | 1116 |
| 23114 | 1180 |
| 23115 | 1258 |
| 23116 | 1309 |
| 23117 | 1340 |
| 23118 | 1370 |
| 23119 | 1402 |
| 23120 | 1432 |
| 23121 | 1464 |
| 23122 | 1472 |
| 23123 | 1466 |
| 23124 | 1429 |
| 23125 | 1392 |
| 23126 | 1368 |
| 23127 | 1344 |
| 23128 | 1268 |
| 23129 | 1202 |
| 23130 | 1148 |
| 23131 | 1083 |
| 23132 | 1014 |
| 23133 | 963 |
| 23134 | 910 |
| 23135 | 869 |
| 23136 | 849 |
| 23137 | 822 |
| 23138 | 795 |
| 23139 | 778 |
| 23140 | 756 |
| 23141 | 734 |
| 23142 | 721 |
| 23143 | 712 |
| 23144 | 704 |
| 23145 | 695 |
| 23146 | 693 |
| 23147 | 694 |
| 23148 | 693 |
| 23149 | 687 |
| 23150 | 689 |
| 23151 | 697 |
| 23152 | 725 |
| 23153 | 737 |
| 23154 | 755 |
| 23155 | 779 |
| 23156 | 832 |
| 23157 | 856 |
| 23158 | 892 |
| 23159 | 959 |
| 23160 | 1071 |
| 23161 | 1111 |
| 23162 | 1125 |
| 23163 | 1168 |
| 23164 | 1234 |
| 23165 | 1258 |
| 23166 | 1269 |
| 23167 | 1291 |
| 23168 | 1342 |
| 23169 | 1330 |
| 23170 | 1316 |
| 23171 | 1308 |
| 23172 | 1232 |
| 23173 | 1153 |
| 23174 | 1159 |
| 23175 | 1148 |
| 23176 | 1131 |
| 23177 | 1141 |
| 23178 | 1169 |
| 23179 | 1152 |
| 23180 | 1180 |
| 23181 | 1226 |
| 23182 | 1264 |
| 23183 | 1260 |
| 23184 | 1182 |
| 23185 | 1063 |
| 23186 | 921 |
| 23187 | 880 |
| 23188 | 916 |
| 23189 | 962 |
| 23190 | 1008 |
| 23191 | 1061 |
| 23192 | 1071 |
| 23193 | 1108 |
| 23194 | 1083 |
| 23195 | 1071 |
| 23196 | 1088 |
| 23197 | 1050 |
| 23198 | 1004 |
| 23199 | 1017 |
| 23200 | 1041 |
| 23201 | 1063 |
| 23202 | 1077 |
| 23203 | 1127 |
| 23204 | 1199 |
| 23205 | 1261 |
| 23206 | 1337 |
| 23207 | 1409 |
| 23208 | 1469 |
| 23209 | 1524 |
| 23210 | 1563 |
| 23211 | 1602 |
| 23212 | 1611 |
| 23213 | 1609 |
| 23214 | 1616 |
| 23215 | 1617 |
| 23216 | 1646 |
| 23217 | 1658 |
| 23218 | 1674 |
| 23219 | 1650 |
| 23220 | 1593 |
| 23221 | 1527 |
| 23222 | 1474 |
| 23223 | 1436 |
| 23224 | 1360 |
| 23225 | 1285 |
| 23226 | 1202 |
| 23227 | 1125 |
| 23228 | 1054 |
| 23229 | 1002 |
| 23230 | 952 |
| 23231 | 908 |
| 23232 | 885 |
| 23233 | 864 |
| 23234 | 836 |
| 23235 | 816 |
| 23236 | 799 |
| 23237 | 784 |
| 23238 | 771 |
| 23239 | 760 |
| 23240 | 753 |
| 23241 | 747 |
| 23242 | 744 |
| 23243 | 742 |
| 23244 | 743 |
| 23245 | 744 |
| 23246 | 746 |
| 23247 | 748 |
| 23248 | 768 |
| 23249 | 774 |
| 23250 | 790 |
| 23251 | 815 |
| 23252 | 865 |
| 23253 | 886 |
| 23254 | 923 |
| 23255 | 988 |
| 23256 | 1092 |
| 23257 | 1155 |
| 23258 | 1159 |
| 23259 | 1192 |
| 23260 | 1264 |
| 23261 | 1297 |
| 23262 | 1317 |
| 23263 | 1339 |
| 23264 | 1364 |
| 23265 | 1372 |
| 23266 | 1374 |
| 23267 | 1374 |
| 23268 | 1341 |
| 23269 | 1316 |
| 23270 | 1312 |
| 23271 | 1277 |
| 23272 | 1285 |
| 23273 | 1294 |
| 23274 | 1237 |
| 23275 | 1239 |
| 23276 | 1276 |
| 23277 | 1339 |
| 23278 | 1322 |
| 23279 | 1302 |
| 23280 | 1308 |
| 23281 | 1302 |
| 23282 | 1238 |
| 23283 | 1204 |
| 23284 | 1142 |
| 23285 | 1133 |
| 23286 | 1140 |
| 23287 | 1152 |
| 23288 | 1167 |
| 23289 | 1210 |
| 23290 | 1228 |
| 23291 | 1180 |
| 23292 | 1178 |
| 23293 | 1154 |
| 23294 | 1123 |
| 23295 | 1152 |
| 23296 | 1179 |
| 23297 | 1173 |
| 23298 | 1160 |
| 23299 | 1165 |
| 23300 | 1216 |
| 23301 | 1290 |
| 23302 | 1364 |
| 23303 | 1442 |
| 23304 | 1493 |
| 23305 | 1524 |
| 23306 | 1552 |
| 23307 | 1564 |
| 23308 | 1554 |
| 23309 | 1556 |
| 23310 | 1565 |
| 23311 | 1590 |
| 23312 | 1623 |
| 23313 | 1654 |
| 23314 | 1673 |
| 23315 | 1642 |
| 23316 | 1582 |
| 23317 | 1522 |
| 23318 | 1475 |
| 23319 | 1427 |
| 23320 | 1356 |
| 23321 | 1281 |
| 23322 | 1209 |
| 23323 | 1141 |
| 23324 | 1068 |
| 23325 | 1014 |
| 23326 | 967 |
| 23327 | 926 |
| 23328 | 901 |
| 23329 | 870 |
| 23330 | 840 |
| 23331 | 817 |
| 23332 | 799 |
| 23333 | 777 |
| 23334 | 764 |
| 23335 | 752 |
| 23336 | 751 |
| 23337 | 739 |
| 23338 | 735 |
| 23339 | 730 |
| 23340 | 733 |
| 23341 | 724 |
| 23342 | 724 |
| 23343 | 733 |
| 23344 | 760 |
| 23345 | 768 |
| 23346 | 786 |
| 23347 | 806 |
| 23348 | 853 |
| 23349 | 874 |
| 23350 | 912 |
| 23351 | 972 |
| 23352 | 1086 |
| 23353 | 1122 |
| 23354 | 1154 |
| 23355 | 1182 |
| 23356 | 1243 |
| 23357 | 1265 |
| 23358 | 1290 |
| 23359 | 1304 |
| 23360 | 1338 |
| 23361 | 1324 |
| 23362 | 1302 |
| 23363 | 1279 |
| 23364 | 1246 |
| 23365 | 1240 |
| 23366 | 1214 |
| 23367 | 1170 |
| 23368 | 1139 |
| 23369 | 1097 |
| 23370 | 1109 |
| 23371 | 1120 |
| 23372 | 1155 |
| 23373 | 1173 |
| 23374 | 1199 |
| 23375 | 1228 |
| 23376 | 1214 |
| 23377 | 1170 |
| 23378 | 1116 |
| 23379 | 1097 |
| 23380 | 1122 |
| 23381 | 1082 |
| 23382 | 1031 |
| 23383 | 1021 |
| 23384 | 1005 |
| 23385 | 1019 |
| 23386 | 1019 |
| 23387 | 1003 |
| 23388 | 992 |
| 23389 | 1019 |
| 23390 | 1025 |
| 23391 | 1014 |
| 23392 | 1016 |
| 23393 | 1047 |
| 23394 | 1082 |
| 23395 | 1114 |
| 23396 | 1161 |
| 23397 | 1221 |
| 23398 | 1274 |
| 23399 | 1323 |
| 23400 | 1361 |
| 23401 | 1391 |
| 23402 | 1443 |
| 23403 | 1493 |
| 23404 | 1525 |
| 23405 | 1541 |
| 23406 | 1563 |
| 23407 | 1591 |
| 23408 | 1617 |
| 23409 | 1653 |
| 23410 | 1654 |
| 23411 | 1654 |
| 23412 | 1609 |
| 23413 | 1553 |
| 23414 | 1504 |
| 23415 | 1462 |
| 23416 | 1376 |
| 23417 | 1305 |
| 23418 | 1228 |
| 23419 | 1163 |
| 23420 | 1081 |
| 23421 | 1015 |
| 23422 | 961 |
| 23423 | 916 |
| 23424 | 900 |
| 23425 | 875 |
| 23426 | 846 |
| 23427 | 826 |
| 23428 | 804 |
| 23429 | 787 |
| 23430 | 773 |
| 23431 | 763 |
| 23432 | 755 |
| 23433 | 747 |
| 23434 | 739 |
| 23435 | 738 |
| 23436 | 739 |
| 23437 | 735 |
| 23438 | 736 |
| 23439 | 736 |
| 23440 | 755 |
| 23441 | 760 |
| 23442 | 781 |
| 23443 | 804 |
| 23444 | 858 |
| 23445 | 875 |
| 23446 | 917 |
| 23447 | 981 |
| 23448 | 1088 |
| 23449 | 1133 |
| 23450 | 1173 |
| 23451 | 1187 |
| 23452 | 1248 |
| 23453 | 1279 |
| 23454 | 1287 |
| 23455 | 1288 |
| 23456 | 1294 |
| 23457 | 1288 |
| 23458 | 1290 |
| 23459 | 1292 |
| 23460 | 1288 |
| 23461 | 1284 |
| 23462 | 1254 |
| 23463 | 1218 |
| 23464 | 1210 |
| 23465 | 1145 |
| 23466 | 1112 |
| 23467 | 1091 |
| 23468 | 1120 |
| 23469 | 1177 |
| 23470 | 1223 |
| 23471 | 1233 |
| 23472 | 1215 |
| 23473 | 1169 |
| 23474 | 1132 |
| 23475 | 1130 |
| 23476 | 1130 |
| 23477 | 1093 |
| 23478 | 1047 |
| 23479 | 1019 |
| 23480 | 958 |
| 23481 | 869 |
| 23482 | 803 |
| 23483 | 868 |
| 23484 | 976 |
| 23485 | 957 |
| 23486 | 967 |
| 23487 | 983 |
| 23488 | 1014 |
| 23489 | 998 |
| 23490 | 1006 |
| 23491 | 1040 |
| 23492 | 1126 |
| 23493 | 1160 |
| 23494 | 1234 |
| 23495 | 1295 |
| 23496 | 1357 |
| 23497 | 1406 |
| 23498 | 1435 |
| 23499 | 1489 |
| 23500 | 1516 |
| 23501 | 1530 |
| 23502 | 1554 |
| 23503 | 1584 |
| 23504 | 1613 |
| 23505 | 1643 |
| 23506 | 1658 |
| 23507 | 1626 |
| 23508 | 1579 |
| 23509 | 1524 |
| 23510 | 1476 |
| 23511 | 1432 |
| 23512 | 1359 |
| 23513 | 1283 |
| 23514 | 1214 |
| 23515 | 1145 |
| 23516 | 1073 |
| 23517 | 1011 |
| 23518 | 962 |
| 23519 | 921 |
| 23520 | 893 |
| 23521 | 863 |
| 23522 | 831 |
| 23523 | 809 |
| 23524 | 790 |
| 23525 | 771 |
| 23526 | 759 |
| 23527 | 751 |
| 23528 | 740 |
| 23529 | 729 |
| 23530 | 725 |
| 23531 | 724 |
| 23532 | 723 |
| 23533 | 718 |
| 23534 | 723 |
| 23535 | 725 |
| 23536 | 742 |
| 23537 | 751 |
| 23538 | 771 |
| 23539 | 791 |
| 23540 | 839 |
| 23541 | 867 |
| 23542 | 909 |
| 23543 | 975 |
| 23544 | 1076 |
| 23545 | 1132 |
| 23546 | 1154 |
| 23547 | 1194 |
| 23548 | 1266 |
| 23549 | 1305 |
| 23550 | 1337 |
| 23551 | 1358 |
| 23552 | 1401 |
| 23553 | 1416 |
| 23554 | 1433 |
| 23555 | 1430 |
| 23556 | 1409 |
| 23557 | 1370 |
| 23558 | 1337 |
| 23559 | 1298 |
| 23560 | 1238 |
| 23561 | 1172 |
| 23562 | 1161 |
| 23563 | 1181 |
| 23564 | 1216 |
| 23565 | 1272 |
| 23566 | 1265 |
| 23567 | 1252 |
| 23568 | 1208 |
| 23569 | 1201 |
| 23570 | 1149 |
| 23571 | 1147 |
| 23572 | 1132 |
| 23573 | 1127 |
| 23574 | 1109 |
| 23575 | 1077 |
| 23576 | 1048 |
| 23577 | 1054 |
| 23578 | 1046 |
| 23579 | 1037 |
| 23580 | 1007 |
| 23581 | 1008 |
| 23582 | 1046 |
| 23583 | 1075 |
| 23584 | 1101 |
| 23585 | 1118 |
| 23586 | 1139 |
| 23587 | 1180 |
| 23588 | 1210 |
| 23589 | 1253 |
| 23590 | 1296 |
| 23591 | 1357 |
| 23592 | 1407 |
| 23593 | 1461 |
| 23594 | 1510 |
| 23595 | 1538 |
| 23596 | 1544 |
| 23597 | 1551 |
| 23598 | 1559 |
| 23599 | 1589 |
| 23600 | 1600 |
| 23601 | 1608 |
| 23602 | 1614 |
| 23603 | 1590 |
| 23604 | 1545 |
| 23605 | 1494 |
| 23606 | 1452 |
| 23607 | 1413 |
| 23608 | 1349 |
| 23609 | 1298 |
| 23610 | 1240 |
| 23611 | 1184 |
| 23612 | 1128 |
| 23613 | 1079 |
| 23614 | 1020 |
| 23615 | 985 |
| 23616 | 954 |
| 23617 | 926 |
| 23618 | 892 |
| 23619 | 870 |
| 23620 | 848 |
| 23621 | 825 |
| 23622 | 799 |
| 23623 | 782 |
| 23624 | 773 |
| 23625 | 764 |
| 23626 | 755 |
| 23627 | 755 |
| 23628 | 751 |
| 23629 | 741 |
| 23630 | 734 |
| 23631 | 736 |
| 23632 | 746 |
| 23633 | 747 |
| 23634 | 750 |
| 23635 | 746 |
| 23636 | 769 |
| 23637 | 776 |
| 23638 | 793 |
| 23639 | 828 |
| 23640 | 893 |
| 23641 | 914 |
| 23642 | 926 |
| 23643 | 953 |
| 23644 | 979 |
| 23645 | 1007 |
| 23646 | 1038 |
| 23647 | 1063 |
| 23648 | 1103 |
| 23649 | 1154 |
| 23650 | 1180 |
| 23651 | 1194 |
| 23652 | 1209 |
| 23653 | 1244 |
| 23654 | 1259 |
| 23655 | 1215 |
| 23656 | 1182 |
| 23657 | 1145 |
| 23658 | 1149 |
| 23659 | 1081 |
| 23660 | 1018 |
| 23661 | 1002 |
| 23662 | 1029 |
| 23663 | 1082 |
| 23664 | 1086 |
| 23665 | 1035 |
| 23666 | 971 |
| 23667 | 936 |
| 23668 | 913 |
| 23669 | 945 |
| 23670 | 972 |
| 23671 | 1004 |
| 23672 | 1034 |
| 23673 | 1001 |
| 23674 | 905 |
| 23675 | 957 |
| 23676 | 1010 |
| 23677 | 1019 |
| 23678 | 1059 |
| 23679 | 1100 |
| 23680 | 1088 |
| 23681 | 1059 |
| 23682 | 1061 |
| 23683 | 1078 |
| 23684 | 1091 |
| 23685 | 1138 |
| 23686 | 1206 |
| 23687 | 1263 |
| 23688 | 1306 |
| 23689 | 1356 |
| 23690 | 1411 |
| 23691 | 1455 |
| 23692 | 1481 |
| 23693 | 1495 |
| 23694 | 1504 |
| 23695 | 1518 |
| 23696 | 1549 |
| 23697 | 1564 |
| 23698 | 1550 |
| 23699 | 1523 |
| 23700 | 1474 |
| 23701 | 1435 |
| 23702 | 1403 |
| 23703 | 1368 |
| 23704 | 1312 |
| 23705 | 1265 |
| 23706 | 1219 |
| 23707 | 1175 |
| 23708 | 1120 |
| 23709 | 1072 |
| 23710 | 1025 |
| 23711 | 979 |
| 23712 | 955 |
| 23713 | 918 |
| 23714 | 884 |
| 23715 | 857 |
| 23716 | 838 |
| 23717 | 810 |
| 23718 | 790 |
| 23719 | 771 |
| 23720 | 758 |
| 23721 | 748 |
| 23722 | 734 |
| 23723 | 727 |
| 23724 | 727 |
| 23725 | 723 |
| 23726 | 718 |
| 23727 | 718 |
| 23728 | 720 |
| 23729 | 719 |
| 23730 | 719 |
| 23731 | 721 |
| 23732 | 733 |
| 23733 | 731 |
| 23734 | 736 |
| 23735 | 746 |
| 23736 | 773 |
| 23737 | 785 |
| 23738 | 794 |
| 23739 | 781 |
| 23740 | 798 |
| 23741 | 821 |
| 23742 | 842 |
| 23743 | 872 |
| 23744 | 898 |
| 23745 | 914 |
| 23746 | 952 |
| 23747 | 1006 |
| 23748 | 1061 |
| 23749 | 1073 |
| 23750 | 1069 |
| 23751 | 1060 |
| 23752 | 1058 |
| 23753 | 1081 |
| 23754 | 1076 |
| 23755 | 1095 |
| 23756 | 1128 |
| 23757 | 1237 |
| 23758 | 1253 |
| 23759 | 1211 |
| 23760 | 1094 |
| 23761 | 870 |
| 23762 | 774 |
| 23763 | 761 |
| 23764 | 789 |
| 23765 | 789 |
| 23766 | 783 |
| 23767 | 737 |
| 23768 | 729 |
| 23769 | 692 |
| 23770 | 657 |
| 23771 | 577 |
| 23772 | 620 |
| 23773 | 625 |
| 23774 | 656 |
| 23775 | 672 |
| 23776 | 680 |
| 23777 | 733 |
| 23778 | 797 |
| 23779 | 825 |
| 23780 | 844 |
| 23781 | 906 |
| 23782 | 989 |
| 23783 | 1071 |
| 23784 | 1115 |
| 23785 | 1149 |
| 23786 | 1219 |
| 23787 | 1300 |
| 23788 | 1347 |
| 23789 | 1369 |
| 23790 | 1403 |
| 23791 | 1444 |
| 23792 | 1503 |
| 23793 | 1530 |
| 23794 | 1517 |
| 23795 | 1480 |
| 23796 | 1441 |
| 23797 | 1401 |
| 23798 | 1377 |
| 23799 | 1350 |
| 23800 | 1271 |
| 23801 | 1208 |
| 23802 | 1147 |
| 23803 | 1082 |
| 23804 | 1013 |
| 23805 | 958 |
| 23806 | 907 |
| 23807 | 864 |
| 23808 | 844 |
| 23809 | 821 |
| 23810 | 793 |
| 23811 | 770 |
| 23812 | 746 |
| 23813 | 726 |
| 23814 | 712 |
| 23815 | 705 |
| 23816 | 697 |
| 23817 | 689 |
| 23818 | 689 |
| 23819 | 688 |
| 23820 | 689 |
| 23821 | 685 |
| 23822 | 688 |
| 23823 | 695 |
| 23824 | 724 |
| 23825 | 734 |
| 23826 | 755 |
| 23827 | 779 |
| 23828 | 830 |
| 23829 | 857 |
| 23830 | 899 |
| 23831 | 974 |
| 23832 | 1096 |
| 23833 | 1173 |
| 23834 | 1201 |
| 23835 | 1234 |
| 23836 | 1287 |
| 23837 | 1319 |
| 23838 | 1336 |
| 23839 | 1359 |
| 23840 | 1413 |
| 23841 | 1426 |
| 23842 | 1417 |
| 23843 | 1411 |
| 23844 | 1376 |
| 23845 | 1300 |
| 23846 | 1275 |
| 23847 | 1271 |
| 23848 | 1260 |
| 23849 | 1268 |
| 23850 | 1269 |
| 23851 | 1242 |
| 23852 | 1271 |
| 23853 | 1291 |
| 23854 | 1282 |
| 23855 | 1280 |
| 23856 | 1240 |
| 23857 | 1149 |
| 23858 | 1012 |
| 23859 | 958 |
| 23860 | 1016 |
| 23861 | 1070 |
| 23862 | 1095 |
| 23863 | 1148 |
| 23864 | 1163 |
| 23865 | 1148 |
| 23866 | 1100 |
| 23867 | 1072 |
| 23868 | 1081 |
| 23869 | 1088 |
| 23870 | 1047 |
| 23871 | 1083 |
| 23872 | 1097 |
| 23873 | 1111 |
| 23874 | 1108 |
| 23875 | 1152 |
| 23876 | 1215 |
| 23877 | 1274 |
| 23878 | 1349 |
| 23879 | 1417 |
| 23880 | 1465 |
| 23881 | 1503 |
| 23882 | 1525 |
| 23883 | 1568 |
| 23884 | 1588 |
| 23885 | 1595 |
| 23886 | 1616 |
| 23887 | 1643 |
| 23888 | 1693 |
| 23889 | 1703 |
| 23890 | 1692 |
| 23891 | 1652 |
| 23892 | 1595 |
| 23893 | 1530 |
| 23894 | 1475 |
| 23895 | 1428 |
| 23896 | 1356 |
| 23897 | 1278 |
| 23898 | 1197 |
| 23899 | 1120 |
| 23900 | 1053 |
| 23901 | 996 |
| 23902 | 947 |
| 23903 | 904 |
| 23904 | 885 |
| 23905 | 862 |
| 23906 | 834 |
| 23907 | 811 |
| 23908 | 794 |
| 23909 | 780 |
| 23910 | 769 |
| 23911 | 759 |
| 23912 | 752 |
| 23913 | 747 |
| 23914 | 742 |
| 23915 | 740 |
| 23916 | 740 |
| 23917 | 742 |
| 23918 | 743 |
| 23919 | 748 |
| 23920 | 768 |
| 23921 | 775 |
| 23922 | 793 |
| 23923 | 819 |
| 23924 | 864 |
| 23925 | 884 |
| 23926 | 930 |
| 23927 | 1001 |
| 23928 | 1118 |
| 23929 | 1192 |
| 23930 | 1224 |
| 23931 | 1246 |
| 23932 | 1308 |
| 23933 | 1330 |
| 23934 | 1339 |
| 23935 | 1348 |
| 23936 | 1355 |
| 23937 | 1350 |
| 23938 | 1330 |
| 23939 | 1312 |
| 23940 | 1251 |
| 23941 | 1215 |
| 23942 | 1191 |
| 23943 | 1130 |
| 23944 | 1118 |
| 23945 | 1110 |
| 23946 | 1037 |
| 23947 | 1036 |
| 23948 | 1078 |
| 23949 | 1162 |
| 23950 | 1162 |
| 23951 | 1119 |
| 23952 | 1106 |
| 23953 | 1080 |
| 23954 | 1037 |
| 23955 | 1000 |
| 23956 | 958 |
| 23957 | 939 |
| 23958 | 946 |
| 23959 | 972 |
| 23960 | 962 |
| 23961 | 972 |
| 23962 | 959 |
| 23963 | 952 |
| 23964 | 952 |
| 23965 | 939 |
| 23966 | 939 |
| 23967 | 977 |
| 23968 | 1014 |
| 23969 | 1023 |
| 23970 | 1040 |
| 23971 | 1064 |
| 23972 | 1119 |
| 23973 | 1182 |
| 23974 | 1265 |
| 23975 | 1333 |
| 23976 | 1388 |
| 23977 | 1436 |
| 23978 | 1483 |
| 23979 | 1521 |
| 23980 | 1534 |
| 23981 | 1546 |
| 23982 | 1576 |
| 23983 | 1624 |
| 23984 | 1680 |
| 23985 | 1696 |
| 23986 | 1688 |
| 23987 | 1651 |
| 23988 | 1592 |
| 23989 | 1525 |
| 23990 | 1477 |
| 23991 | 1424 |
| 23992 | 1347 |
| 23993 | 1272 |
| 23994 | 1203 |
| 23995 | 1133 |
| 23996 | 1054 |
| 23997 | 998 |
| 23998 | 954 |
| 23999 | 916 |
| 24000 | 891 |
| 24001 | 856 |
| 24002 | 829 |
| 24003 | 811 |
| 24004 | 791 |
| 24005 | 770 |
| 24006 | 757 |
| 24007 | 745 |
| 24008 | 742 |
| 24009 | 733 |
| 24010 | 728 |
| 24011 | 725 |
| 24012 | 727 |
| 24013 | 720 |
| 24014 | 720 |
| 24015 | 729 |
| 24016 | 756 |
| 24017 | 765 |
| 24018 | 786 |
| 24019 | 806 |
| 24020 | 850 |
| 24021 | 878 |
| 24022 | 923 |
| 24023 | 987 |
| 24024 | 1108 |
| 24025 | 1178 |
| 24026 | 1221 |
| 24027 | 1238 |
| 24028 | 1292 |
| 24029 | 1312 |
| 24030 | 1328 |
| 24031 | 1333 |
| 24032 | 1360 |
| 24033 | 1341 |
| 24034 | 1318 |
| 24035 | 1280 |
| 24036 | 1240 |
| 24037 | 1233 |
| 24038 | 1205 |
| 24039 | 1159 |
| 24040 | 1125 |
| 24041 | 1092 |
| 24042 | 1089 |
| 24043 | 1105 |
| 24044 | 1149 |
| 24045 | 1175 |
| 24046 | 1195 |
| 24047 | 1234 |
| 24048 | 1211 |
| 24049 | 1158 |
| 24050 | 1102 |
| 24051 | 1103 |
| 24052 | 1108 |
| 24053 | 1071 |
| 24054 | 1044 |
| 24055 | 1042 |
| 24056 | 1023 |
| 24057 | 1021 |
| 24058 | 1041 |
| 24059 | 1032 |
| 24060 | 1023 |
| 24061 | 1043 |
| 24062 | 1073 |
| 24063 | 1074 |
| 24064 | 1072 |
| 24065 | 1113 |
| 24066 | 1158 |
| 24067 | 1179 |
| 24068 | 1228 |
| 24069 | 1291 |
| 24070 | 1350 |
| 24071 | 1402 |
| 24072 | 1433 |
| 24073 | 1465 |
| 24074 | 1516 |
| 24075 | 1557 |
| 24076 | 1584 |
| 24077 | 1599 |
| 24078 | 1622 |
| 24079 | 1672 |
| 24080 | 1717 |
| 24081 | 1734 |
| 24082 | 1702 |
| 24083 | 1671 |
| 24084 | 1613 |
| 24085 | 1550 |
| 24086 | 1500 |
| 24087 | 1454 |
| 24088 | 1365 |
| 24089 | 1292 |
| 24090 | 1216 |
| 24091 | 1150 |
| 24092 | 1070 |
| 24093 | 1004 |
| 24094 | 950 |
| 24095 | 906 |
| 24096 | 888 |
| 24097 | 865 |
| 24098 | 833 |
| 24099 | 814 |
| 24100 | 794 |
| 24101 | 777 |
| 24102 | 761 |
| 24103 | 752 |
| 24104 | 748 |
| 24105 | 741 |
| 24106 | 733 |
| 24107 | 732 |
| 24108 | 735 |
| 24109 | 730 |
| 24110 | 733 |
| 24111 | 732 |
| 24112 | 751 |
| 24113 | 756 |
| 24114 | 778 |
| 24115 | 802 |
| 24116 | 856 |
| 24117 | 876 |
| 24118 | 917 |
| 24119 | 984 |
| 24120 | 1105 |
| 24121 | 1180 |
| 24122 | 1243 |
| 24123 | 1256 |
| 24124 | 1308 |
| 24125 | 1351 |
| 24126 | 1379 |
| 24127 | 1394 |
| 24128 | 1408 |
| 24129 | 1398 |
| 24130 | 1399 |
| 24131 | 1405 |
| 24132 | 1408 |
| 24133 | 1402 |
| 24134 | 1371 |
| 24135 | 1312 |
| 24136 | 1300 |
| 24137 | 1237 |
| 24138 | 1187 |
| 24139 | 1177 |
| 24140 | 1216 |
| 24141 | 1280 |
| 24142 | 1338 |
| 24143 | 1347 |
| 24144 | 1321 |
| 24145 | 1254 |
| 24146 | 1213 |
| 24147 | 1209 |
| 24148 | 1174 |
| 24149 | 1143 |
| 24150 | 1148 |
| 24151 | 1114 |
| 24152 | 1082 |
| 24153 | 1012 |
| 24154 | 978 |
| 24155 | 1023 |
| 24156 | 1086 |
| 24157 | 1096 |
| 24158 | 1096 |
| 24159 | 1113 |
| 24160 | 1127 |
| 24161 | 1085 |
| 24162 | 1073 |
| 24163 | 1086 |
| 24164 | 1130 |
| 24165 | 1185 |
| 24166 | 1269 |
| 24167 | 1341 |
| 24168 | 1401 |
| 24169 | 1446 |
| 24170 | 1476 |
| 24171 | 1543 |
| 24172 | 1573 |
| 24173 | 1595 |
| 24174 | 1626 |
| 24175 | 1677 |
| 24176 | 1705 |
| 24177 | 1723 |
| 24178 | 1697 |
| 24179 | 1648 |
| 24180 | 1588 |
| 24181 | 1535 |
| 24182 | 1483 |
| 24183 | 1436 |
| 24184 | 1360 |
| 24185 | 1284 |
| 24186 | 1209 |
| 24187 | 1138 |
| 24188 | 1064 |
| 24189 | 1005 |
| 24190 | 957 |
| 24191 | 915 |
| 24192 | 892 |
| 24193 | 863 |
| 24194 | 832 |
| 24195 | 813 |
| 24196 | 792 |
| 24197 | 773 |
| 24198 | 760 |
| 24199 | 751 |
| 24200 | 743 |
| 24201 | 733 |
| 24202 | 730 |
| 24203 | 728 |
| 24204 | 729 |
| 24205 | 725 |
| 24206 | 732 |
| 24207 | 733 |
| 24208 | 749 |
| 24209 | 758 |
| 24210 | 780 |
| 24211 | 798 |
| 24212 | 846 |
| 24213 | 875 |
| 24214 | 923 |
| 24215 | 993 |
| 24216 | 1104 |
| 24217 | 1177 |
| 24218 | 1225 |
| 24219 | 1253 |
| 24220 | 1312 |
| 24221 | 1343 |
| 24222 | 1364 |
| 24223 | 1392 |
| 24224 | 1424 |
| 24225 | 1425 |
| 24226 | 1410 |
| 24227 | 1380 |
| 24228 | 1335 |
| 24229 | 1277 |
| 24230 | 1252 |
| 24231 | 1233 |
| 24232 | 1208 |
| 24233 | 1177 |
| 24234 | 1156 |
| 24235 | 1160 |
| 24236 | 1195 |
| 24237 | 1237 |
| 24238 | 1314 |
| 24239 | 1360 |
| 24240 | 1364 |
| 24241 | 1333 |
| 24242 | 1321 |
| 24243 | 1392 |
| 24244 | 1380 |
| 24245 | 1362 |
| 24246 | 1320 |
| 24247 | 1304 |
| 24248 | 1298 |
| 24249 | 1263 |
| 24250 | 1216 |
| 24251 | 1142 |
| 24252 | 1078 |
| 24253 | 1079 |
| 24254 | 1095 |
| 24255 | 1109 |
| 24256 | 1147 |
| 24257 | 1217 |
| 24258 | 1264 |
| 24259 | 1287 |
| 24260 | 1315 |
| 24261 | 1353 |
| 24262 | 1409 |
| 24263 | 1429 |
| 24264 | 1465 |
| 24265 | 1509 |
| 24266 | 1553 |
| 24267 | 1585 |
| 24268 | 1599 |
| 24269 | 1609 |
| 24270 | 1634 |
| 24271 | 1687 |
| 24272 | 1691 |
| 24273 | 1687 |
| 24274 | 1657 |
| 24275 | 1611 |
| 24276 | 1557 |
| 24277 | 1505 |
| 24278 | 1466 |
| 24279 | 1424 |
| 24280 | 1359 |
| 24281 | 1304 |
| 24282 | 1242 |
| 24283 | 1193 |
| 24284 | 1134 |
| 24285 | 1081 |
| 24286 | 1020 |
| 24287 | 984 |
| 24288 | 959 |
| 24289 | 930 |
| 24290 | 894 |
| 24291 | 873 |
| 24292 | 848 |
| 24293 | 823 |
| 24294 | 797 |
| 24295 | 781 |
| 24296 | 770 |
| 24297 | 765 |
| 24298 | 759 |
| 24299 | 757 |
| 24300 | 756 |
| 24301 | 745 |
| 24302 | 738 |
| 24303 | 740 |
| 24304 | 745 |
| 24305 | 747 |
| 24306 | 751 |
| 24307 | 750 |
| 24308 | 768 |
| 24309 | 772 |
| 24310 | 792 |
| 24311 | 830 |
| 24312 | 900 |
| 24313 | 932 |
| 24314 | 959 |
| 24315 | 977 |
| 24316 | 1002 |
| 24317 | 1041 |
| 24318 | 1085 |
| 24319 | 1126 |
| 24320 | 1180 |
| 24321 | 1223 |
| 24322 | 1262 |
| 24323 | 1297 |
| 24324 | 1320 |
| 24325 | 1326 |
| 24326 | 1346 |
| 24327 | 1338 |
| 24328 | 1319 |
| 24329 | 1289 |
| 24330 | 1253 |
| 24331 | 1179 |
| 24332 | 1134 |
| 24333 | 1135 |
| 24334 | 1168 |
| 24335 | 1218 |
| 24336 | 1255 |
| 24337 | 1208 |
| 24338 | 1158 |
| 24339 | 1083 |
| 24340 | 1028 |
| 24341 | 1002 |
| 24342 | 973 |
| 24343 | 935 |
| 24344 | 931 |
| 24345 | 967 |
| 24346 | 973 |
| 24347 | 989 |
| 24348 | 992 |
| 24349 | 1068 |
| 24350 | 1131 |
| 24351 | 1164 |
| 24352 | 1174 |
| 24353 | 1188 |
| 24354 | 1205 |
| 24355 | 1251 |
| 24356 | 1276 |
| 24357 | 1307 |
| 24358 | 1331 |
| 24359 | 1354 |
| 24360 | 1379 |
| 24361 | 1416 |
| 24362 | 1459 |
| 24363 | 1491 |
| 24364 | 1517 |
| 24365 | 1541 |
| 24366 | 1561 |
| 24367 | 1597 |
| 24368 | 1621 |
| 24369 | 1615 |
| 24370 | 1573 |
| 24371 | 1540 |
| 24372 | 1487 |
| 24373 | 1445 |
| 24374 | 1413 |
| 24375 | 1375 |
| 24376 | 1315 |
| 24377 | 1266 |
| 24378 | 1220 |
| 24379 | 1174 |
| 24380 | 1116 |
| 24381 | 1065 |
| 24382 | 1016 |
| 24383 | 971 |
| 24384 | 949 |
| 24385 | 916 |
| 24386 | 884 |
| 24387 | 856 |
| 24388 | 833 |
| 24389 | 807 |
| 24390 | 788 |
| 24391 | 772 |
| 24392 | 759 |
| 24393 | 746 |
| 24394 | 733 |
| 24395 | 726 |
| 24396 | 722 |
| 24397 | 713 |
| 24398 | 706 |
| 24399 | 705 |
| 24400 | 711 |
| 24401 | 712 |
| 24402 | 717 |
| 24403 | 717 |
| 24404 | 729 |
| 24405 | 729 |
| 24406 | 731 |
| 24407 | 741 |
| 24408 | 769 |
| 24409 | 780 |
| 24410 | 799 |
| 24411 | 798 |
| 24412 | 821 |
| 24413 | 844 |
| 24414 | 866 |
| 24415 | 902 |
| 24416 | 936 |
| 24417 | 960 |
| 24418 | 999 |
| 24419 | 1056 |
| 24420 | 1117 |
| 24421 | 1148 |
| 24422 | 1179 |
| 24423 | 1190 |
| 24424 | 1171 |
| 24425 | 1161 |
| 24426 | 1164 |
| 24427 | 1198 |
| 24428 | 1251 |
| 24429 | 1315 |
| 24430 | 1313 |
| 24431 | 1267 |
| 24432 | 1154 |
| 24433 | 1016 |
| 24434 | 956 |
| 24435 | 957 |
| 24436 | 933 |
| 24437 | 866 |
| 24438 | 836 |
| 24439 | 789 |
| 24440 | 806 |
| 24441 | 764 |
| 24442 | 736 |
| 24443 | 753 |
| 24444 | 814 |
| 24445 | 826 |
| 24446 | 805 |
| 24447 | 797 |
| 24448 | 762 |
| 24449 | 776 |
| 24450 | 836 |
| 24451 | 892 |
| 24452 | 959 |
| 24453 | 1020 |
| 24454 | 1091 |
| 24455 | 1167 |
| 24456 | 1231 |
| 24457 | 1297 |
| 24458 | 1335 |
| 24459 | 1387 |
| 24460 | 1419 |
| 24461 | 1441 |
| 24462 | 1479 |
| 24463 | 1530 |
| 24464 | 1585 |
| 24465 | 1590 |
| 24466 | 1540 |
| 24467 | 1482 |
| 24468 | 1438 |
| 24469 | 1394 |
| 24470 | 1366 |
| 24471 | 1333 |
| 24472 | 1257 |
| 24473 | 1190 |
| 24474 | 1126 |
| 24475 | 1065 |
| 24476 | 996 |
| 24477 | 937 |
| 24478 | 889 |
| 24479 | 851 |
| 24480 | 835 |
| 24481 | 812 |
| 24482 | 785 |
| 24483 | 760 |
| 24484 | 739 |
| 24485 | 721 |
| 24486 | 708 |
| 24487 | 699 |
| 24488 | 696 |
| 24489 | 690 |
| 24490 | 688 |
| 24491 | 684 |
| 24492 | 686 |
| 24493 | 682 |
| 24494 | 683 |
| 24495 | 689 |
| 24496 | 718 |
| 24497 | 732 |
| 24498 | 753 |
| 24499 | 778 |
| 24500 | 830 |
| 24501 | 860 |
| 24502 | 913 |
| 24503 | 988 |
| 24504 | 1117 |
| 24505 | 1207 |
| 24506 | 1267 |
| 24507 | 1302 |
| 24508 | 1334 |
| 24509 | 1362 |
| 24510 | 1385 |
| 24511 | 1404 |
| 24512 | 1449 |
| 24513 | 1454 |
| 24514 | 1445 |
| 24515 | 1458 |
| 24516 | 1454 |
| 24517 | 1419 |
| 24518 | 1385 |
| 24519 | 1335 |
| 24520 | 1310 |
| 24521 | 1296 |
| 24522 | 1286 |
| 24523 | 1275 |
| 24524 | 1310 |
| 24525 | 1315 |
| 24526 | 1290 |
| 24527 | 1254 |
| 24528 | 1193 |
| 24529 | 1162 |
| 24530 | 1107 |
| 24531 | 1125 |
| 24532 | 1111 |
| 24533 | 1106 |
| 24534 | 1135 |
| 24535 | 1107 |
| 24536 | 1149 |
| 24537 | 1259 |
| 24538 | 1216 |
| 24539 | 1122 |
| 24540 | 1087 |
| 24541 | 1076 |
| 24542 | 1059 |
| 24543 | 1011 |
| 24544 | 980 |
| 24545 | 1013 |
| 24546 | 1038 |
| 24547 | 1097 |
| 24548 | 1167 |
| 24549 | 1232 |
| 24550 | 1326 |
| 24551 | 1404 |
| 24552 | 1472 |
| 24553 | 1506 |
| 24554 | 1536 |
| 24555 | 1595 |
| 24556 | 1626 |
| 24557 | 1641 |
| 24558 | 1677 |
| 24559 | 1739 |
| 24560 | 1775 |
| 24561 | 1761 |
| 24562 | 1722 |
| 24563 | 1668 |
| 24564 | 1606 |
| 24565 | 1538 |
| 24566 | 1483 |
| 24567 | 1437 |
| 24568 | 1361 |
| 24569 | 1281 |
| 24570 | 1200 |
| 24571 | 1124 |
| 24572 | 1053 |
| 24573 | 997 |
| 24574 | 947 |
| 24575 | 906 |
| 24576 | 894 |
| 24577 | 870 |
| 24578 | 842 |
| 24579 | 818 |
| 24580 | 803 |
| 24581 | 788 |
| 24582 | 774 |
| 24583 | 768 |
| 24584 | 759 |
| 24585 | 750 |
| 24586 | 743 |
| 24587 | 742 |
| 24588 | 744 |
| 24589 | 742 |
| 24590 | 746 |
| 24591 | 748 |
| 24592 | 770 |
| 24593 | 780 |
| 24594 | 797 |
| 24595 | 824 |
| 24596 | 873 |
| 24597 | 895 |
| 24598 | 944 |
| 24599 | 1020 |
| 24600 | 1145 |
| 24601 | 1227 |
| 24602 | 1292 |
| 24603 | 1324 |
| 24604 | 1365 |
| 24605 | 1389 |
| 24606 | 1394 |
| 24607 | 1394 |
| 24608 | 1398 |
| 24609 | 1377 |
| 24610 | 1344 |
| 24611 | 1323 |
| 24612 | 1243 |
| 24613 | 1215 |
| 24614 | 1194 |
| 24615 | 1131 |
| 24616 | 1111 |
| 24617 | 1087 |
| 24618 | 1038 |
| 24619 | 1019 |
| 24620 | 998 |
| 24621 | 1021 |
| 24622 | 1021 |
| 24623 | 980 |
| 24624 | 981 |
| 24625 | 977 |
| 24626 | 942 |
| 24627 | 888 |
| 24628 | 825 |
| 24629 | 826 |
| 24630 | 798 |
| 24631 | 788 |
| 24632 | 793 |
| 24633 | 770 |
| 24634 | 734 |
| 24635 | 735 |
| 24636 | 744 |
| 24637 | 766 |
| 24638 | 811 |
| 24639 | 835 |
| 24640 | 857 |
| 24641 | 911 |
| 24642 | 946 |
| 24643 | 974 |
| 24644 | 1038 |
| 24645 | 1098 |
| 24646 | 1195 |
| 24647 | 1279 |
| 24648 | 1359 |
| 24649 | 1424 |
| 24650 | 1487 |
| 24651 | 1547 |
| 24652 | 1576 |
| 24653 | 1599 |
| 24654 | 1653 |
| 24655 | 1725 |
| 24656 | 1768 |
| 24657 | 1760 |
| 24658 | 1719 |
| 24659 | 1676 |
| 24660 | 1612 |
| 24661 | 1542 |
| 24662 | 1495 |
| 24663 | 1447 |
| 24664 | 1368 |
| 24665 | 1295 |
| 24666 | 1221 |
| 24667 | 1145 |
| 24668 | 1062 |
| 24669 | 1005 |
| 24670 | 962 |
| 24671 | 924 |
| 24672 | 900 |
| 24673 | 876 |
| 24674 | 848 |
| 24675 | 830 |
| 24676 | 809 |
| 24677 | 790 |
| 24678 | 777 |
| 24679 | 764 |
| 24680 | 760 |
| 24681 | 756 |
| 24682 | 750 |
| 24683 | 748 |
| 24684 | 751 |
| 24685 | 743 |
| 24686 | 746 |
| 24687 | 750 |
| 24688 | 771 |
| 24689 | 782 |
| 24690 | 802 |
| 24691 | 825 |
| 24692 | 869 |
| 24693 | 896 |
| 24694 | 951 |
| 24695 | 1024 |
| 24696 | 1155 |
| 24697 | 1240 |
| 24698 | 1306 |
| 24699 | 1331 |
| 24700 | 1375 |
| 24701 | 1398 |
| 24702 | 1411 |
| 24703 | 1422 |
| 24704 | 1425 |
| 24705 | 1415 |
| 24706 | 1383 |
| 24707 | 1318 |
| 24708 | 1275 |
| 24709 | 1255 |
| 24710 | 1224 |
| 24711 | 1153 |
| 24712 | 1148 |
| 24713 | 1106 |
| 24714 | 1112 |
| 24715 | 1124 |
| 24716 | 1121 |
| 24717 | 1075 |
| 24718 | 1018 |
| 24719 | 1089 |
| 24720 | 1057 |
| 24721 | 982 |
| 24722 | 905 |
| 24723 | 945 |
| 24724 | 990 |
| 24725 | 988 |
| 24726 | 967 |
| 24727 | 999 |
| 24728 | 974 |
| 24729 | 993 |
| 24730 | 972 |
| 24731 | 971 |
| 24732 | 1043 |
| 24733 | 1066 |
| 24734 | 1071 |
| 24735 | 1088 |
| 24736 | 1101 |
| 24737 | 1127 |
| 24738 | 1163 |
| 24739 | 1183 |
| 24740 | 1241 |
| 24741 | 1295 |
| 24742 | 1354 |
| 24743 | 1421 |
| 24744 | 1460 |
| 24745 | 1497 |
| 24746 | 1540 |
| 24747 | 1583 |
| 24748 | 1618 |
| 24749 | 1648 |
| 24750 | 1696 |
| 24751 | 1764 |
| 24752 | 1797 |
| 24753 | 1774 |
| 24754 | 1732 |
| 24755 | 1695 |
| 24756 | 1634 |
| 24757 | 1570 |
| 24758 | 1520 |
| 24759 | 1467 |
| 24760 | 1381 |
| 24761 | 1303 |
| 24762 | 1221 |
| 24763 | 1153 |
| 24764 | 1069 |
| 24765 | 1011 |
| 24766 | 953 |
| 24767 | 907 |
| 24768 | 893 |
| 24769 | 873 |
| 24770 | 845 |
| 24771 | 825 |
| 24772 | 803 |
| 24773 | 782 |
| 24774 | 762 |
| 24775 | 759 |
| 24776 | 757 |
| 24777 | 750 |
| 24778 | 746 |
| 24779 | 743 |
| 24780 | 745 |
| 24781 | 739 |
| 24782 | 740 |
| 24783 | 739 |
| 24784 | 759 |
| 24785 | 765 |
| 24786 | 790 |
| 24787 | 819 |
| 24788 | 873 |
| 24789 | 893 |
| 24790 | 941 |
| 24791 | 1013 |
| 24792 | 1144 |
| 24793 | 1229 |
| 24794 | 1305 |
| 24795 | 1335 |
| 24796 | 1379 |
| 24797 | 1409 |
| 24798 | 1439 |
| 24799 | 1462 |
| 24800 | 1477 |
| 24801 | 1468 |
| 24802 | 1462 |
| 24803 | 1455 |
| 24804 | 1456 |
| 24805 | 1456 |
| 24806 | 1437 |
| 24807 | 1382 |
| 24808 | 1385 |
| 24809 | 1330 |
| 24810 | 1273 |
| 24811 | 1240 |
| 24812 | 1259 |
| 24813 | 1321 |
| 24814 | 1369 |
| 24815 | 1341 |
| 24816 | 1321 |
| 24817 | 1266 |
| 24818 | 1205 |
| 24819 | 1171 |
| 24820 | 1148 |
| 24821 | 1125 |
| 24822 | 1171 |
| 24823 | 1135 |
| 24824 | 1128 |
| 24825 | 1050 |
| 24826 | 1020 |
| 24827 | 1088 |
| 24828 | 1119 |
| 24829 | 1119 |
| 24830 | 1161 |
| 24831 | 1160 |
| 24832 | 1148 |
| 24833 | 1127 |
| 24834 | 1139 |
| 24835 | 1150 |
| 24836 | 1207 |
| 24837 | 1252 |
| 24838 | 1329 |
| 24839 | 1410 |
| 24840 | 1480 |
| 24841 | 1515 |
| 24842 | 1551 |
| 24843 | 1615 |
| 24844 | 1649 |
| 24845 | 1687 |
| 24846 | 1751 |
| 24847 | 1799 |
| 24848 | 1814 |
| 24849 | 1796 |
| 24850 | 1740 |
| 24851 | 1680 |
| 24852 | 1616 |
| 24853 | 1563 |
| 24854 | 1520 |
| 24855 | 1467 |
| 24856 | 1383 |
| 24857 | 1305 |
| 24858 | 1226 |
| 24859 | 1146 |
| 24860 | 1065 |
| 24861 | 1007 |
| 24862 | 962 |
| 24863 | 917 |
| 24864 | 895 |
| 24865 | 870 |
| 24866 | 836 |
| 24867 | 815 |
| 24868 | 793 |
| 24869 | 773 |
| 24870 | 756 |
| 24871 | 750 |
| 24872 | 743 |
| 24873 | 732 |
| 24874 | 730 |
| 24875 | 731 |
| 24876 | 735 |
| 24877 | 732 |
| 24878 | 739 |
| 24879 | 742 |
| 24880 | 755 |
| 24881 | 762 |
| 24882 | 786 |
| 24883 | 807 |
| 24884 | 857 |
| 24885 | 884 |
| 24886 | 938 |
| 24887 | 1014 |
| 24888 | 1137 |
| 24889 | 1222 |
| 24890 | 1297 |
| 24891 | 1332 |
| 24892 | 1378 |
| 24893 | 1405 |
| 24894 | 1425 |
| 24895 | 1453 |
| 24896 | 1478 |
| 24897 | 1473 |
| 24898 | 1480 |
| 24899 | 1463 |
| 24900 | 1415 |
| 24901 | 1382 |
| 24902 | 1340 |
| 24903 | 1318 |
| 24904 | 1282 |
| 24905 | 1247 |
| 24906 | 1209 |
| 24907 | 1229 |
| 24908 | 1306 |
| 24909 | 1373 |
| 24910 | 1431 |
| 24911 | 1463 |
| 24912 | 1453 |
| 24913 | 1419 |
| 24914 | 1399 |
| 24915 | 1453 |
| 24916 | 1434 |
| 24917 | 1428 |
| 24918 | 1410 |
| 24919 | 1408 |
| 24920 | 1412 |
| 24921 | 1366 |
| 24922 | 1310 |
| 24923 | 1247 |
| 24924 | 1192 |
| 24925 | 1223 |
| 24926 | 1251 |
| 24927 | 1269 |
| 24928 | 1313 |
| 24929 | 1373 |
| 24930 | 1417 |
| 24931 | 1440 |
| 24932 | 1462 |
| 24933 | 1485 |
| 24934 | 1528 |
| 24935 | 1547 |
| 24936 | 1573 |
| 24937 | 1612 |
| 24938 | 1650 |
| 24939 | 1673 |
| 24940 | 1678 |
| 24941 | 1700 |
| 24942 | 1746 |
| 24943 | 1789 |
| 24944 | 1779 |
| 24945 | 1733 |
| 24946 | 1683 |
| 24947 | 1628 |
| 24948 | 1575 |
| 24949 | 1529 |
| 24950 | 1493 |
| 24951 | 1455 |
| 24952 | 1384 |
| 24953 | 1324 |
| 24954 | 1264 |
| 24955 | 1213 |
| 24956 | 1145 |
| 24957 | 1092 |
| 24958 | 1029 |
| 24959 | 990 |
| 24960 | 968 |
| 24961 | 940 |
| 24962 | 900 |
| 24963 | 881 |
| 24964 | 856 |
| 24965 | 830 |
| 24966 | 804 |
| 24967 | 789 |
| 24968 | 779 |
| 24969 | 774 |
| 24970 | 768 |
| 24971 | 766 |
| 24972 | 765 |
| 24973 | 756 |
| 24974 | 745 |
| 24975 | 751 |
| 24976 | 756 |
| 24977 | 761 |
| 24978 | 761 |
| 24979 | 760 |
| 24980 | 776 |
| 24981 | 781 |
| 24982 | 800 |
| 24983 | 839 |
| 24984 | 909 |
| 24985 | 939 |
| 24986 | 980 |
| 24987 | 1008 |
| 24988 | 1027 |
| 24989 | 1064 |
| 24990 | 1111 |
| 24991 | 1163 |
| 24992 | 1218 |
| 24993 | 1264 |
| 24994 | 1300 |
| 24995 | 1334 |
| 24996 | 1352 |
| 24997 | 1362 |
| 24998 | 1382 |
| 24999 | 1383 |
| 25000 | 1386 |
| 25001 | 1385 |
| 25002 | 1351 |
| 25003 | 1301 |
| 25004 | 1274 |
| 25005 | 1241 |
| 25006 | 1202 |
| 25007 | 1202 |
| 25008 | 1211 |
| 25009 | 1179 |
| 25010 | 1153 |
| 25011 | 1059 |
| 25012 | 999 |
| 25013 | 980 |
| 25014 | 968 |
| 25015 | 925 |
| 25016 | 923 |
| 25017 | 973 |
| 25018 | 995 |
| 25019 | 1000 |
| 25020 | 984 |
| 25021 | 1037 |
| 25022 | 1104 |
| 25023 | 1166 |
| 25024 | 1179 |
| 25025 | 1220 |
| 25026 | 1251 |
| 25027 | 1308 |
| 25028 | 1358 |
| 25029 | 1396 |
| 25030 | 1426 |
| 25031 | 1442 |
| 25032 | 1465 |
| 25033 | 1499 |
| 25034 | 1535 |
| 25035 | 1563 |
| 25036 | 1586 |
| 25037 | 1615 |
| 25038 | 1665 |
| 25039 | 1700 |
| 25040 | 1703 |
| 25041 | 1652 |
| 25042 | 1585 |
| 25043 | 1550 |
| 25044 | 1508 |
| 25045 | 1456 |
| 25046 | 1431 |
| 25047 | 1394 |
| 25048 | 1335 |
| 25049 | 1285 |
| 25050 | 1237 |
| 25051 | 1191 |
| 25052 | 1126 |
| 25053 | 1075 |
| 25054 | 1023 |
| 25055 | 982 |
| 25056 | 962 |
| 25057 | 935 |
| 25058 | 899 |
| 25059 | 870 |
| 25060 | 846 |
| 25061 | 820 |
| 25062 | 797 |
| 25063 | 776 |
| 25064 | 765 |
| 25065 | 752 |
| 25066 | 737 |
| 25067 | 729 |
| 25068 | 723 |
| 25069 | 716 |
| 25070 | 711 |
| 25071 | 709 |
| 25072 | 715 |
| 25073 | 714 |
| 25074 | 720 |
| 25075 | 720 |
| 25076 | 734 |
| 25077 | 734 |
| 25078 | 735 |
| 25079 | 743 |
| 25080 | 774 |
| 25081 | 787 |
| 25082 | 809 |
| 25083 | 822 |
| 25084 | 834 |
| 25085 | 859 |
| 25086 | 894 |
| 25087 | 930 |
| 25088 | 962 |
| 25089 | 991 |
| 25090 | 1020 |
| 25091 | 1058 |
| 25092 | 1093 |
| 25093 | 1121 |
| 25094 | 1131 |
| 25095 | 1118 |
| 25096 | 1106 |
| 25097 | 1103 |
| 25098 | 1114 |
| 25099 | 1138 |
| 25100 | 1155 |
| 25101 | 1191 |
| 25102 | 1171 |
| 25103 | 1118 |
| 25104 | 1041 |
| 25105 | 960 |
| 25106 | 915 |
| 25107 | 913 |
| 25108 | 878 |
| 25109 | 848 |
| 25110 | 834 |
| 25111 | 818 |
| 25112 | 824 |
| 25113 | 801 |
| 25114 | 791 |
| 25115 | 818 |
| 25116 | 880 |
| 25117 | 898 |
| 25118 | 883 |
| 25119 | 882 |
| 25120 | 868 |
| 25121 | 870 |
| 25122 | 916 |
| 25123 | 953 |
| 25124 | 1014 |
| 25125 | 1064 |
| 25126 | 1131 |
| 25127 | 1197 |
| 25128 | 1257 |
| 25129 | 1328 |
| 25130 | 1377 |
| 25131 | 1436 |
| 25132 | 1475 |
| 25133 | 1512 |
| 25134 | 1577 |
| 25135 | 1621 |
| 25136 | 1652 |
| 25137 | 1616 |
| 25138 | 1548 |
| 25139 | 1488 |
| 25140 | 1448 |
| 25141 | 1403 |
| 25142 | 1373 |
| 25143 | 1340 |
| 25144 | 1267 |
| 25145 | 1198 |
| 25146 | 1129 |
| 25147 | 1076 |
| 25148 | 1011 |
| 25149 | 949 |
| 25150 | 897 |
| 25151 | 858 |
| 25152 | 840 |
| 25153 | 816 |
| 25154 | 790 |
| 25155 | 767 |
| 25156 | 748 |
| 25157 | 730 |
| 25158 | 719 |
| 25159 | 706 |
| 25160 | 703 |
| 25161 | 700 |
| 25162 | 695 |
| 25163 | 691 |
| 25164 | 695 |
| 25165 | 688 |
| 25166 | 693 |
| 25167 | 698 |
| 25168 | 728 |
| 25169 | 746 |
| 25170 | 768 |
| 25171 | 793 |
| 25172 | 846 |
| 25173 | 877 |
| 25174 | 931 |
| 25175 | 1002 |
| 25176 | 1133 |
| 25177 | 1227 |
| 25178 | 1303 |
| 25179 | 1353 |
| 25180 | 1379 |
| 25181 | 1404 |
| 25182 | 1422 |
| 25183 | 1435 |
| 25184 | 1468 |
| 25185 | 1489 |
| 25186 | 1493 |
| 25187 | 1482 |
| 25188 | 1438 |
| 25189 | 1407 |
| 25190 | 1393 |
| 25191 | 1365 |
| 25192 | 1341 |
| 25193 | 1331 |
| 25194 | 1338 |
| 25195 | 1354 |
| 25196 | 1390 |
| 25197 | 1413 |
| 25198 | 1402 |
| 25199 | 1348 |
| 25200 | 1257 |
| 25201 | 1219 |
| 25202 | 1152 |
| 25203 | 1146 |
| 25204 | 1154 |
| 25205 | 1146 |
| 25206 | 1143 |
| 25207 | 1083 |
| 25208 | 1118 |
| 25209 | 1231 |
| 25210 | 1208 |
| 25211 | 1128 |
| 25212 | 1074 |
| 25213 | 1074 |
| 25214 | 1099 |
| 25215 | 1025 |
| 25216 | 991 |
| 25217 | 1063 |
| 25218 | 1095 |
| 25219 | 1163 |
| 25220 | 1231 |
| 25221 | 1317 |
| 25222 | 1422 |
| 25223 | 1499 |
| 25224 | 1558 |
| 25225 | 1583 |
| 25226 | 1612 |
| 25227 | 1657 |
| 25228 | 1700 |
| 25229 | 1735 |
| 25230 | 1790 |
| 25231 | 1839 |
| 25232 | 1847 |
| 25233 | 1797 |
| 25234 | 1730 |
| 25235 | 1668 |
| 25236 | 1611 |
| 25237 | 1549 |
| 25238 | 1495 |
| 25239 | 1444 |
| 25240 | 1367 |
| 25241 | 1285 |
| 25242 | 1209 |
| 25243 | 1136 |
| 25244 | 1066 |
| 25245 | 1006 |
| 25246 | 957 |
| 25247 | 914 |
| 25248 | 902 |
| 25249 | 878 |
| 25250 | 848 |
| 25251 | 823 |
| 25252 | 806 |
| 25253 | 786 |
| 25254 | 769 |
| 25255 | 760 |
| 25256 | 754 |
| 25257 | 744 |
| 25258 | 728 |
| 25259 | 734 |
| 25260 | 742 |
| 25261 | 739 |
| 25262 | 742 |
| 25263 | 748 |
| 25264 | 770 |
| 25265 | 781 |
| 25266 | 798 |
| 25267 | 826 |
| 25268 | 869 |
| 25269 | 891 |
| 25270 | 945 |
| 25271 | 1026 |
| 25272 | 1154 |
| 25273 | 1238 |
| 25274 | 1313 |
| 25275 | 1359 |
| 25276 | 1404 |
| 25277 | 1423 |
| 25278 | 1434 |
| 25279 | 1446 |
| 25280 | 1461 |
| 25281 | 1449 |
| 25282 | 1421 |
| 25283 | 1406 |
| 25284 | 1346 |
| 25285 | 1326 |
| 25286 | 1290 |
| 25287 | 1262 |
| 25288 | 1253 |
| 25289 | 1220 |
| 25290 | 1184 |
| 25291 | 1157 |
| 25292 | 1130 |
| 25293 | 1123 |
| 25294 | 1150 |
| 25295 | 1159 |
| 25296 | 1164 |
| 25297 | 1157 |
| 25298 | 1144 |
| 25299 | 1107 |
| 25300 | 1063 |
| 25301 | 1063 |
| 25302 | 1039 |
| 25303 | 1033 |
| 25304 | 1051 |
| 25305 | 1010 |
| 25306 | 948 |
| 25307 | 927 |
| 25308 | 910 |
| 25309 | 944 |
| 25310 | 976 |
| 25311 | 989 |
| 25312 | 992 |
| 25313 | 1045 |
| 25314 | 1088 |
| 25315 | 1119 |
| 25316 | 1163 |
| 25317 | 1214 |
| 25318 | 1284 |
| 25319 | 1370 |
| 25320 | 1434 |
| 25321 | 1498 |
| 25322 | 1564 |
| 25323 | 1633 |
| 25324 | 1683 |
| 25325 | 1728 |
| 25326 | 1785 |
| 25327 | 1836 |
| 25328 | 1847 |
| 25329 | 1798 |
| 25330 | 1737 |
| 25331 | 1692 |
| 25332 | 1633 |
| 25333 | 1571 |
| 25334 | 1525 |
| 25335 | 1478 |
| 25336 | 1395 |
| 25337 | 1318 |
| 25338 | 1241 |
| 25339 | 1159 |
| 25340 | 1076 |
| 25341 | 1017 |
| 25342 | 971 |
| 25343 | 929 |
| 25344 | 909 |
| 25345 | 885 |
| 25346 | 855 |
| 25347 | 837 |
| 25348 | 818 |
| 25349 | 799 |
| 25350 | 786 |
| 25351 | 775 |
| 25352 | 767 |
| 25353 | 764 |
| 25354 | 759 |
| 25355 | 756 |
| 25356 | 757 |
| 25357 | 750 |
| 25358 | 756 |
| 25359 | 761 |
| 25360 | 783 |
| 25361 | 793 |
| 25362 | 813 |
| 25363 | 837 |
| 25364 | 881 |
| 25365 | 909 |
| 25366 | 962 |
| 25367 | 1035 |
| 25368 | 1162 |
| 25369 | 1254 |
| 25370 | 1328 |
| 25371 | 1376 |
| 25372 | 1415 |
| 25373 | 1434 |
| 25374 | 1443 |
| 25375 | 1451 |
| 25376 | 1454 |
| 25377 | 1449 |
| 25378 | 1439 |
| 25379 | 1383 |
| 25380 | 1354 |
| 25381 | 1342 |
| 25382 | 1323 |
| 25383 | 1274 |
| 25384 | 1269 |
| 25385 | 1212 |
| 25386 | 1206 |
| 25387 | 1199 |
| 25388 | 1152 |
| 25389 | 1087 |
| 25390 | 985 |
| 25391 | 981 |
| 25392 | 905 |
| 25393 | 824 |
| 25394 | 764 |
| 25395 | 781 |
| 25396 | 807 |
| 25397 | 814 |
| 25398 | 812 |
| 25399 | 846 |
| 25400 | 840 |
| 25401 | 861 |
| 25402 | 845 |
| 25403 | 853 |
| 25404 | 931 |
| 25405 | 952 |
| 25406 | 947 |
| 25407 | 958 |
| 25408 | 991 |
| 25409 | 1032 |
| 25410 | 1088 |
| 25411 | 1112 |
| 25412 | 1184 |
| 25413 | 1260 |
| 25414 | 1348 |
| 25415 | 1436 |
| 25416 | 1491 |
| 25417 | 1541 |
| 25418 | 1586 |
| 25419 | 1635 |
| 25420 | 1681 |
| 25421 | 1744 |
| 25422 | 1810 |
| 25423 | 1860 |
| 25424 | 1857 |
| 25425 | 1806 |
| 25426 | 1746 |
| 25427 | 1701 |
| 25428 | 1638 |
| 25429 | 1580 |
| 25430 | 1536 |
| 25431 | 1485 |
| 25432 | 1399 |
| 25433 | 1323 |
| 25434 | 1245 |
| 25435 | 1168 |
| 25436 | 1084 |
| 25437 | 1024 |
| 25438 | 967 |
| 25439 | 921 |
| 25440 | 905 |
| 25441 | 882 |
| 25442 | 855 |
| 25443 | 831 |
| 25444 | 808 |
| 25445 | 780 |
| 25446 | 758 |
| 25447 | 754 |
| 25448 | 755 |
| 25449 | 747 |
| 25450 | 744 |
| 25451 | 740 |
| 25452 | 737 |
| 25453 | 731 |
| 25454 | 730 |
| 25455 | 733 |
| 25456 | 753 |
| 25457 | 759 |
| 25458 | 786 |
| 25459 | 816 |
| 25460 | 868 |
| 25461 | 891 |
| 25462 | 948 |
| 25463 | 1014 |
| 25464 | 1145 |
| 25465 | 1232 |
| 25466 | 1313 |
| 25467 | 1367 |
| 25468 | 1409 |
| 25469 | 1436 |
| 25470 | 1460 |
| 25471 | 1491 |
| 25472 | 1512 |
| 25473 | 1526 |
| 25474 | 1536 |
| 25475 | 1537 |
| 25476 | 1510 |
| 25477 | 1495 |
| 25478 | 1511 |
| 25479 | 1496 |
| 25480 | 1511 |
| 25481 | 1489 |
| 25482 | 1437 |
| 25483 | 1414 |
| 25484 | 1388 |
| 25485 | 1407 |
| 25486 | 1412 |
| 25487 | 1352 |
| 25488 | 1335 |
| 25489 | 1311 |
| 25490 | 1237 |
| 25491 | 1190 |
| 25492 | 1199 |
| 25493 | 1197 |
| 25494 | 1276 |
| 25495 | 1254 |
| 25496 | 1287 |
| 25497 | 1227 |
| 25498 | 1214 |
| 25499 | 1217 |
| 25500 | 1150 |
| 25501 | 1128 |
| 25502 | 1172 |
| 25503 | 1164 |
| 25504 | 1152 |
| 25505 | 1201 |
| 25506 | 1253 |
| 25507 | 1266 |
| 25508 | 1313 |
| 25509 | 1354 |
| 25510 | 1419 |
| 25511 | 1500 |
| 25512 | 1561 |
| 25513 | 1606 |
| 25514 | 1658 |
| 25515 | 1722 |
| 25516 | 1766 |
| 25517 | 1801 |
| 25518 | 1861 |
| 25519 | 1892 |
| 25520 | 1874 |
| 25521 | 1823 |
| 25522 | 1752 |
| 25523 | 1692 |
| 25524 | 1632 |
| 25525 | 1582 |
| 25526 | 1549 |
| 25527 | 1494 |
| 25528 | 1406 |
| 25529 | 1326 |
| 25530 | 1247 |
| 25531 | 1169 |
| 25532 | 1090 |
| 25533 | 1029 |
| 25534 | 980 |
| 25535 | 932 |
| 25536 | 914 |
| 25537 | 888 |
| 25538 | 858 |
| 25539 | 838 |
| 25540 | 814 |
| 25541 | 793 |
| 25542 | 775 |
| 25543 | 764 |
| 25544 | 755 |
| 25545 | 745 |
| 25546 | 742 |
| 25547 | 744 |
| 25548 | 750 |
| 25549 | 748 |
| 25550 | 749 |
| 25551 | 755 |
| 25552 | 770 |
| 25553 | 780 |
| 25554 | 804 |
| 25555 | 828 |
| 25556 | 874 |
| 25557 | 895 |
| 25558 | 948 |
| 25559 | 1024 |
| 25560 | 1153 |
| 25561 | 1240 |
| 25562 | 1318 |
| 25563 | 1366 |
| 25564 | 1411 |
| 25565 | 1435 |
| 25566 | 1447 |
| 25567 | 1467 |
| 25568 | 1485 |
| 25569 | 1480 |
| 25570 | 1485 |
| 25571 | 1467 |
| 25572 | 1407 |
| 25573 | 1385 |
| 25574 | 1349 |
| 25575 | 1311 |
| 25576 | 1260 |
| 25577 | 1245 |
| 25578 | 1218 |
| 25579 | 1244 |
| 25580 | 1333 |
| 25581 | 1414 |
| 25582 | 1472 |
| 25583 | 1482 |
| 25584 | 1467 |
| 25585 | 1452 |
| 25586 | 1396 |
| 25587 | 1412 |
| 25588 | 1397 |
| 25589 | 1350 |
| 25590 | 1319 |
| 25591 | 1332 |
| 25592 | 1347 |
| 25593 | 1299 |
| 25594 | 1235 |
| 25595 | 1164 |
| 25596 | 1105 |
| 25597 | 1150 |
| 25598 | 1186 |
| 25599 | 1215 |
| 25600 | 1277 |
| 25601 | 1340 |
| 25602 | 1390 |
| 25603 | 1417 |
| 25604 | 1437 |
| 25605 | 1470 |
| 25606 | 1517 |
| 25607 | 1548 |
| 25608 | 1575 |
| 25609 | 1629 |
| 25610 | 1678 |
| 25611 | 1721 |
| 25612 | 1739 |
| 25613 | 1765 |
| 25614 | 1811 |
| 25615 | 1842 |
| 25616 | 1824 |
| 25617 | 1767 |
| 25618 | 1717 |
| 25619 | 1671 |
| 25620 | 1616 |
| 25621 | 1571 |
| 25622 | 1539 |
| 25623 | 1496 |
| 25624 | 1425 |
| 25625 | 1361 |
| 25626 | 1304 |
| 25627 | 1247 |
| 25628 | 1175 |
| 25629 | 1119 |
| 25630 | 1066 |
| 25631 | 1020 |
| 25632 | 996 |
| 25633 | 965 |
| 25634 | 926 |
| 25635 | 902 |
| 25636 | 878 |
| 25637 | 850 |
| 25638 | 829 |
| 25639 | 818 |
| 25640 | 809 |
| 25641 | 799 |
| 25642 | 789 |
| 25643 | 783 |
| 25644 | 784 |
| 25645 | 776 |
| 25646 | 767 |
| 25647 | 770 |
| 25648 | 778 |
| 25649 | 782 |
| 25650 | 786 |
| 25651 | 792 |
| 25652 | 802 |
| 25653 | 803 |
| 25654 | 819 |
| 25655 | 854 |
| 25656 | 924 |
| 25657 | 952 |
| 25658 | 992 |
| 25659 | 1025 |
| 25660 | 1056 |
| 25661 | 1094 |
| 25662 | 1137 |
| 25663 | 1189 |
| 25664 | 1236 |
| 25665 | 1276 |
| 25666 | 1310 |
| 25667 | 1337 |
| 25668 | 1349 |
| 25669 | 1349 |
| 25670 | 1378 |
| 25671 | 1390 |
| 25672 | 1395 |
| 25673 | 1408 |
| 25674 | 1360 |
| 25675 | 1310 |
| 25676 | 1296 |
| 25677 | 1255 |
| 25678 | 1179 |
| 25679 | 1134 |
| 25680 | 1119 |
| 25681 | 1094 |
| 25682 | 1080 |
| 25683 | 1004 |
| 25684 | 941 |
| 25685 | 911 |
| 25686 | 902 |
| 25687 | 858 |
| 25688 | 867 |
| 25689 | 924 |
| 25690 | 952 |
| 25691 | 963 |
| 25692 | 944 |
| 25693 | 986 |
| 25694 | 1048 |
| 25695 | 1131 |
| 25696 | 1138 |
| 25697 | 1188 |
| 25698 | 1230 |
| 25699 | 1280 |
| 25700 | 1337 |
| 25701 | 1376 |
| 25702 | 1405 |
| 25703 | 1426 |
| 25704 | 1455 |
| 25705 | 1500 |
| 25706 | 1551 |
| 25707 | 1593 |
| 25708 | 1631 |
| 25709 | 1664 |
| 25710 | 1730 |
| 25711 | 1758 |
| 25712 | 1731 |
| 25713 | 1668 |
| 25714 | 1595 |
| 25715 | 1557 |
| 25716 | 1523 |
| 25717 | 1465 |
| 25718 | 1446 |
| 25719 | 1412 |
| 25720 | 1354 |
| 25721 | 1303 |
| 25722 | 1252 |
| 25723 | 1207 |
| 25724 | 1138 |
| 25725 | 1082 |
| 25726 | 1028 |
| 25727 | 986 |
| 25728 | 957 |
| 25729 | 934 |
| 25730 | 899 |
| 25731 | 868 |
| 25732 | 842 |
| 25733 | 822 |
| 25734 | 800 |
| 25735 | 778 |
| 25736 | 764 |
| 25737 | 749 |
| 25738 | 734 |
| 25739 | 728 |
| 25740 | 722 |
| 25741 | 714 |
| 25742 | 709 |
| 25743 | 709 |
| 25744 | 719 |
| 25745 | 715 |
| 25746 | 724 |
| 25747 | 724 |
| 25748 | 737 |
| 25749 | 739 |
| 25750 | 740 |
| 25751 | 749 |
| 25752 | 778 |
| 25753 | 791 |
| 25754 | 813 |
| 25755 | 836 |
| 25756 | 863 |
| 25757 | 874 |
| 25758 | 909 |
| 25759 | 945 |
| 25760 | 981 |
| 25761 | 1007 |
| 25762 | 1027 |
| 25763 | 1061 |
| 25764 | 1093 |
| 25765 | 1118 |
| 25766 | 1128 |
| 25767 | 1127 |
| 25768 | 1133 |
| 25769 | 1148 |
| 25770 | 1161 |
| 25771 | 1178 |
| 25772 | 1193 |
| 25773 | 1227 |
| 25774 | 1235 |
| 25775 | 1224 |
| 25776 | 1195 |
| 25777 | 1168 |
| 25778 | 1130 |
| 25779 | 1108 |
| 25780 | 1063 |
| 25781 | 1029 |
| 25782 | 1024 |
| 25783 | 1017 |
| 25784 | 995 |
| 25785 | 989 |
| 25786 | 992 |
| 25787 | 996 |
| 25788 | 1020 |
| 25789 | 1033 |
| 25790 | 1029 |
| 25791 | 1025 |
| 25792 | 1028 |
| 25793 | 1033 |
| 25794 | 1060 |
| 25795 | 1094 |
| 25796 | 1163 |
| 25797 | 1214 |
| 25798 | 1267 |
| 25799 | 1318 |
| 25800 | 1378 |
| 25801 | 1440 |
| 25802 | 1488 |
| 25803 | 1546 |
| 25804 | 1595 |
| 25805 | 1642 |
| 25806 | 1688 |
| 25807 | 1707 |
| 25808 | 1689 |
| 25809 | 1633 |
| 25810 | 1568 |
| 25811 | 1505 |
| 25812 | 1469 |
| 25813 | 1426 |
| 25814 | 1393 |
| 25815 | 1362 |
| 25816 | 1288 |
| 25817 | 1218 |
| 25818 | 1147 |
| 25819 | 1093 |
| 25820 | 1027 |
| 25821 | 966 |
| 25822 | 911 |
| 25823 | 871 |
| 25824 | 854 |
| 25825 | 836 |
| 25826 | 812 |
| 25827 | 791 |
| 25828 | 774 |
| 25829 | 755 |
| 25830 | 744 |
| 25831 | 726 |
| 25832 | 720 |
| 25833 | 714 |
| 25834 | 707 |
| 25835 | 705 |
| 25836 | 710 |
| 25837 | 702 |
| 25838 | 705 |
| 25839 | 709 |
| 25840 | 741 |
| 25841 | 760 |
| 25842 | 785 |
| 25843 | 813 |
| 25844 | 868 |
| 25845 | 895 |
| 25846 | 947 |
| 25847 | 1016 |
| 25848 | 1147 |
| 25849 | 1240 |
| 25850 | 1323 |
| 25851 | 1389 |
| 25852 | 1435 |
| 25853 | 1448 |
| 25854 | 1462 |
| 25855 | 1478 |
| 25856 | 1503 |
| 25857 | 1528 |
| 25858 | 1525 |
| 25859 | 1500 |
| 25860 | 1441 |
| 25861 | 1412 |
| 25862 | 1387 |
| 25863 | 1343 |
| 25864 | 1313 |
| 25865 | 1292 |
| 25866 | 1280 |
| 25867 | 1284 |
| 25868 | 1306 |
| 25869 | 1309 |
| 25870 | 1314 |
| 25871 | 1279 |
| 25872 | 1205 |
| 25873 | 1153 |
| 25874 | 1105 |
| 25875 | 1147 |
| 25876 | 1174 |
| 25877 | 1168 |
| 25878 | 1132 |
| 25879 | 984 |
| 25880 | 1015 |
| 25881 | 1111 |
| 25882 | 1099 |
| 25883 | 1032 |
| 25884 | 1005 |
| 25885 | 1013 |
| 25886 | 1074 |
| 25887 | 1001 |
| 25888 | 982 |
| 25889 | 1069 |
| 25890 | 1108 |
| 25891 | 1148 |
| 25892 | 1208 |
| 25893 | 1302 |
| 25894 | 1417 |
| 25895 | 1508 |
| 25896 | 1580 |
| 25897 | 1619 |
| 25898 | 1661 |
| 25899 | 1716 |
| 25900 | 1780 |
| 25901 | 1843 |
| 25902 | 1891 |
| 25903 | 1911 |
| 25904 | 1883 |
| 25905 | 1824 |
| 25906 | 1753 |
| 25907 | 1694 |
| 25908 | 1630 |
| 25909 | 1567 |
| 25910 | 1520 |
| 25911 | 1472 |
| 25912 | 1387 |
| 25913 | 1307 |
| 25914 | 1225 |
| 25915 | 1150 |
| 25916 | 1076 |
| 25917 | 1018 |
| 25918 | 966 |
| 25919 | 924 |
| 25920 | 912 |
| 25921 | 893 |
| 25922 | 860 |
| 25923 | 833 |
| 25924 | 815 |
| 25925 | 796 |
| 25926 | 780 |
| 25927 | 769 |
| 25928 | 763 |
| 25929 | 751 |
| 25930 | 732 |
| 25931 | 740 |
| 25932 | 747 |
| 25933 | 744 |
| 25934 | 746 |
| 25935 | 751 |
| 25936 | 777 |
| 25937 | 786 |
| 25938 | 804 |
| 25939 | 831 |
| 25940 | 878 |
| 25941 | 905 |
| 25942 | 959 |
| 25943 | 1036 |
| 25944 | 1162 |
| 25945 | 1247 |
| 25946 | 1322 |
| 25947 | 1389 |
| 25948 | 1453 |
| 25949 | 1486 |
| 25950 | 1499 |
| 25951 | 1511 |
| 25952 | 1545 |
| 25953 | 1539 |
| 25954 | 1521 |
| 25955 | 1520 |
| 25956 | 1482 |
| 25957 | 1460 |
| 25958 | 1449 |
| 25959 | 1428 |
| 25960 | 1433 |
| 25961 | 1431 |
| 25962 | 1407 |
| 25963 | 1372 |
| 25964 | 1320 |
| 25965 | 1264 |
| 25966 | 1349 |
| 25967 | 1392 |
| 25968 | 1405 |
| 25969 | 1423 |
| 25970 | 1411 |
| 25971 | 1364 |
| 25972 | 1157 |
| 25973 | 1298 |
| 25974 | 1304 |
| 25975 | 1271 |
| 25976 | 1275 |
| 25977 | 1239 |
| 25978 | 1203 |
| 25979 | 1158 |
| 25980 | 1111 |
| 25981 | 1137 |
| 25982 | 1160 |
| 25983 | 1165 |
| 25984 | 1148 |
| 25985 | 1173 |
| 25986 | 1214 |
| 25987 | 1248 |
| 25988 | 1293 |
| 25989 | 1361 |
| 25990 | 1417 |
| 25991 | 1503 |
| 25992 | 1559 |
| 25993 | 1618 |
| 25994 | 1681 |
| 25995 | 1739 |
| 25996 | 1805 |
| 25997 | 1850 |
| 25998 | 1888 |
| 25999 | 1901 |
| 26000 | 1869 |
| 26001 | 1805 |
| 26002 | 1737 |
| 26003 | 1689 |
| 26004 | 1644 |
| 26005 | 1586 |
| 26006 | 1542 |
| 26007 | 1502 |
| 26008 | 1426 |
| 26009 | 1348 |
| 26010 | 1273 |
| 26011 | 1183 |
| 26012 | 1097 |
| 26013 | 1029 |
| 26014 | 978 |
| 26015 | 930 |
| 26016 | 913 |
| 26017 | 893 |
| 26018 | 865 |
| 26019 | 843 |
| 26020 | 825 |
| 26021 | 805 |
| 26022 | 793 |
| 26023 | 784 |
| 26024 | 778 |
| 26025 | 772 |
| 26026 | 765 |
| 26027 | 760 |
| 26028 | 764 |
| 26029 | 759 |
| 26030 | 768 |
| 26031 | 774 |
| 26032 | 795 |
| 26033 | 807 |
| 26034 | 830 |
| 26035 | 857 |
| 26036 | 906 |
| 26037 | 929 |
| 26038 | 982 |
| 26039 | 1057 |
| 26040 | 1186 |
| 26041 | 1277 |
| 26042 | 1352 |
| 26043 | 1422 |
| 26044 | 1474 |
| 26045 | 1494 |
| 26046 | 1495 |
| 26047 | 1509 |
| 26048 | 1516 |
| 26049 | 1518 |
| 26050 | 1524 |
| 26051 | 1493 |
| 26052 | 1480 |
| 26053 | 1490 |
| 26054 | 1487 |
| 26055 | 1458 |
| 26056 | 1472 |
| 26057 | 1437 |
| 26058 | 1451 |
| 26059 | 1455 |
| 26060 | 1405 |
| 26061 | 1364 |
| 26062 | 1300 |
| 26063 | 1289 |
| 26064 | 1200 |
| 26065 | 1118 |
| 26066 | 1099 |
| 26067 | 1129 |
| 26068 | 1173 |
| 26069 | 1199 |
| 26070 | 1180 |
| 26071 | 1198 |
| 26072 | 1186 |
| 26073 | 1213 |
| 26074 | 1183 |
| 26075 | 1142 |
| 26076 | 1181 |
| 26077 | 1173 |
| 26078 | 1187 |
| 26079 | 1190 |
| 26080 | 1225 |
| 26081 | 1231 |
| 26082 | 1290 |
| 26083 | 1304 |
| 26084 | 1368 |
| 26085 | 1424 |
| 26086 | 1499 |
| 26087 | 1585 |
| 26088 | 1651 |
| 26089 | 1696 |
| 26090 | 1735 |
| 26091 | 1806 |
| 26092 | 1834 |
| 26093 | 1877 |
| 26094 | 1925 |
| 26095 | 1934 |
| 26096 | 1892 |
| 26097 | 1832 |
| 26098 | 1769 |
| 26099 | 1723 |
| 26100 | 1662 |
| 26101 | 1608 |
| 26102 | 1572 |
| 26103 | 1523 |
| 26104 | 1430 |
| 26105 | 1356 |
| 26106 | 1282 |
| 26107 | 1198 |
| 26108 | 1110 |
| 26109 | 1047 |
| 26110 | 985 |
| 26111 | 937 |
| 26112 | 924 |
| 26113 | 900 |
| 26114 | 871 |
| 26115 | 841 |
| 26116 | 814 |
| 26117 | 783 |
| 26118 | 763 |
| 26119 | 756 |
| 26120 | 756 |
| 26121 | 744 |
| 26122 | 737 |
| 26123 | 735 |
| 26124 | 724 |
| 26125 | 718 |
| 26126 | 717 |
| 26127 | 721 |
| 26128 | 746 |
| 26129 | 753 |
| 26130 | 784 |
| 26131 | 815 |
| 26132 | 868 |
| 26133 | 902 |
| 26134 | 964 |
| 26135 | 1026 |
| 26136 | 1154 |
| 26137 | 1238 |
| 26138 | 1316 |
| 26139 | 1381 |
| 26140 | 1441 |
| 26141 | 1468 |
| 26142 | 1474 |
| 26143 | 1509 |
| 26144 | 1521 |
| 26145 | 1546 |
| 26146 | 1554 |
| 26147 | 1545 |
| 26148 | 1510 |
| 26149 | 1496 |
| 26150 | 1542 |
| 26151 | 1570 |
| 26152 | 1603 |
| 26153 | 1623 |
| 26154 | 1582 |
| 26155 | 1572 |
| 26156 | 1579 |
| 26157 | 1606 |
| 26158 | 1591 |
| 26159 | 1550 |
| 26160 | 1560 |
| 26161 | 1553 |
| 26162 | 1473 |
| 26163 | 1408 |
| 26164 | 1424 |
| 26165 | 1418 |
| 26166 | 1444 |
| 26167 | 1392 |
| 26168 | 1409 |
| 26169 | 1354 |
| 26170 | 1320 |
| 26171 | 1326 |
| 26172 | 1294 |
| 26173 | 1258 |
| 26174 | 1294 |
| 26175 | 1269 |
| 26176 | 1272 |
| 26177 | 1360 |
| 26178 | 1432 |
| 26179 | 1463 |
| 26180 | 1504 |
| 26181 | 1546 |
| 26182 | 1594 |
| 26183 | 1675 |
| 26184 | 1724 |
| 26185 | 1758 |
| 26186 | 1802 |
| 26187 | 1860 |
| 26188 | 1903 |
| 26189 | 1926 |
| 26190 | 1962 |
| 26191 | 1955 |
| 26192 | 1920 |
| 26193 | 1861 |
| 26194 | 1782 |
| 26195 | 1718 |
| 26196 | 1656 |
| 26197 | 1610 |
| 26198 | 1584 |
| 26199 | 1526 |
| 26200 | 1430 |
| 26201 | 1350 |
| 26202 | 1274 |
| 26203 | 1192 |
| 26204 | 1110 |
| 26205 | 1040 |
| 26206 | 989 |
| 26207 | 943 |
| 26208 | 932 |
| 26209 | 906 |
| 26210 | 874 |
| 26211 | 853 |
| 26212 | 828 |
| 26213 | 805 |
| 26214 | 790 |
| 26215 | 779 |
| 26216 | 767 |
| 26217 | 756 |
| 26218 | 749 |
| 26219 | 755 |
| 26220 | 756 |
| 26221 | 755 |
| 26222 | 756 |
| 26223 | 764 |
| 26224 | 783 |
| 26225 | 796 |
| 26226 | 820 |
| 26227 | 849 |
| 26228 | 895 |
| 26229 | 916 |
| 26230 | 967 |
| 26231 | 1048 |
| 26232 | 1171 |
| 26233 | 1261 |
| 26234 | 1340 |
| 26235 | 1408 |
| 26236 | 1474 |
| 26237 | 1514 |
| 26238 | 1519 |
| 26239 | 1538 |
| 26240 | 1570 |
| 26241 | 1572 |
| 26242 | 1590 |
| 26243 | 1586 |
| 26244 | 1537 |
| 26245 | 1528 |
| 26246 | 1491 |
| 26247 | 1429 |
| 26248 | 1343 |
| 26249 | 1322 |
| 26250 | 1322 |
| 26251 | 1376 |
| 26252 | 1455 |
| 26253 | 1531 |
| 26254 | 1580 |
| 26255 | 1584 |
| 26256 | 1547 |
| 26257 | 1574 |
| 26258 | 1444 |
| 26259 | 1384 |
| 26260 | 1358 |
| 26261 | 1274 |
| 26262 | 1255 |
| 26263 | 1319 |
| 26264 | 1378 |
| 26265 | 1373 |
| 26266 | 1335 |
| 26267 | 1314 |
| 26268 | 1294 |
| 26269 | 1334 |
| 26270 | 1346 |
| 26271 | 1394 |
| 26272 | 1458 |
| 26273 | 1474 |
| 26274 | 1496 |
| 26275 | 1514 |
| 26276 | 1530 |
| 26277 | 1576 |
| 26278 | 1624 |
| 26279 | 1677 |
| 26280 | 1699 |
| 26281 | 1745 |
| 26282 | 1802 |
| 26283 | 1854 |
| 26284 | 1885 |
| 26285 | 1903 |
| 26286 | 1919 |
| 26287 | 1904 |
| 26288 | 1865 |
| 26289 | 1793 |
| 26290 | 1737 |
| 26291 | 1694 |
| 26292 | 1642 |
| 26293 | 1596 |
| 26294 | 1566 |
| 26295 | 1528 |
| 26296 | 1460 |
| 26297 | 1394 |
| 26298 | 1336 |
| 26299 | 1274 |
| 26300 | 1204 |
| 26301 | 1144 |
| 26302 | 1088 |
| 26303 | 1043 |
| 26304 | 1022 |
| 26305 | 990 |
| 26306 | 953 |
| 26307 | 923 |
| 26308 | 900 |
| 26309 | 872 |
| 26310 | 852 |
| 26311 | 839 |
| 26312 | 829 |
| 26313 | 818 |
| 26314 | 808 |
| 26315 | 802 |
| 26316 | 799 |
| 26317 | 788 |
| 26318 | 776 |
| 26319 | 777 |
| 26320 | 792 |
| 26321 | 796 |
| 26322 | 802 |
| 26323 | 806 |
| 26324 | 818 |
| 26325 | 820 |
| 26326 | 836 |
| 26327 | 865 |
| 26328 | 938 |
| 26329 | 968 |
| 26330 | 1005 |
| 26331 | 1051 |
| 26332 | 1096 |
| 26333 | 1135 |
| 26334 | 1167 |
| 26335 | 1220 |
| 26336 | 1266 |
| 26337 | 1308 |
| 26338 | 1351 |
| 26339 | 1383 |
| 26340 | 1409 |
| 26341 | 1416 |
| 26342 | 1438 |
| 26343 | 1458 |
| 26344 | 1490 |
| 26345 | 1513 |
| 26346 | 1492 |
| 26347 | 1482 |
| 26348 | 1473 |
| 26349 | 1400 |
| 26350 | 1285 |
| 26351 | 1218 |
| 26352 | 1180 |
| 26353 | 1183 |
| 26354 | 1204 |
| 26355 | 1171 |
| 26356 | 1116 |
| 26357 | 1082 |
| 26358 | 1084 |
| 26359 | 1084 |
| 26360 | 1103 |
| 26361 | 1120 |
| 26362 | 1146 |
| 26363 | 1161 |
| 26364 | 1158 |
| 26365 | 1142 |
| 26366 | 1145 |
| 26367 | 1198 |
| 26368 | 1186 |
| 26369 | 1223 |
| 26370 | 1262 |
| 26371 | 1284 |
| 26372 | 1336 |
| 26373 | 1357 |
| 26374 | 1392 |
| 26375 | 1445 |
| 26376 | 1508 |
| 26377 | 1556 |
| 26378 | 1612 |
| 26379 | 1679 |
| 26380 | 1747 |
| 26381 | 1772 |
| 26382 | 1820 |
| 26383 | 1812 |
| 26384 | 1769 |
| 26385 | 1695 |
| 26386 | 1621 |
| 26387 | 1580 |
| 26388 | 1551 |
| 26389 | 1494 |
| 26390 | 1484 |
| 26391 | 1452 |
| 26392 | 1392 |
| 26393 | 1340 |
| 26394 | 1284 |
| 26395 | 1237 |
| 26396 | 1162 |
| 26397 | 1105 |
| 26398 | 1048 |
| 26399 | 1000 |
| 26400 | 972 |
| 26401 | 950 |
| 26402 | 919 |
| 26403 | 888 |
| 26404 | 861 |
| 26405 | 837 |
| 26406 | 814 |
| 26407 | 797 |
| 26408 | 784 |
| 26409 | 769 |
| 26410 | 754 |
| 26411 | 745 |
| 26412 | 735 |
| 26413 | 732 |
| 26414 | 731 |
| 26415 | 732 |
| 26416 | 739 |
| 26417 | 736 |
| 26418 | 742 |
| 26419 | 745 |
| 26420 | 758 |
| 26421 | 759 |
| 26422 | 762 |
| 26423 | 768 |
| 26424 | 796 |
| 26425 | 808 |
| 26426 | 833 |
| 26427 | 856 |
| 26428 | 884 |
| 26429 | 895 |
| 26430 | 926 |
| 26431 | 961 |
| 26432 | 990 |
| 26433 | 1013 |
| 26434 | 1031 |
| 26435 | 1059 |
| 26436 | 1083 |
| 26437 | 1105 |
| 26438 | 1114 |
| 26439 | 1112 |
| 26440 | 1114 |
| 26441 | 1125 |
| 26442 | 1138 |
| 26443 | 1148 |
| 26444 | 1177 |
| 26445 | 1219 |
| 26446 | 1241 |
| 26447 | 1232 |
| 26448 | 1184 |
| 26449 | 1128 |
| 26450 | 1088 |
| 26451 | 1059 |
| 26452 | 1031 |
| 26453 | 972 |
| 26454 | 972 |
| 26455 | 964 |
| 26456 | 881 |
| 26457 | 789 |
| 26458 | 830 |
| 26459 | 793 |
| 26460 | 766 |
| 26461 | 775 |
| 26462 | 806 |
| 26463 | 854 |
| 26464 | 907 |
| 26465 | 982 |
| 26466 | 1030 |
| 26467 | 1062 |
| 26468 | 1135 |
| 26469 | 1204 |
| 26470 | 1267 |
| 26471 | 1321 |
| 26472 | 1396 |
| 26473 | 1471 |
| 26474 | 1558 |
| 26475 | 1641 |
| 26476 | 1690 |
| 26477 | 1734 |
| 26478 | 1757 |
| 26479 | 1746 |
| 26480 | 1712 |
| 26481 | 1653 |
| 26482 | 1583 |
| 26483 | 1530 |
| 26484 | 1497 |
| 26485 | 1457 |
| 26486 | 1422 |
| 26487 | 1394 |
| 26488 | 1320 |
| 26489 | 1253 |
| 26490 | 1177 |
| 26491 | 1118 |
| 26492 | 1046 |
| 26493 | 982 |
| 26494 | 923 |
| 26495 | 876 |
| 26496 | 971 |
| 26497 | 949 |
| 26498 | 918 |
| 26499 | 887 |
| 26500 | 859 |
| 26501 | 836 |
| 26502 | 814 |
| 26503 | 797 |
| 26504 | 784 |
| 26505 | 768 |
| 26506 | 754 |
| 26507 | 746 |
| 26508 | 738 |
| 26509 | 734 |
| 26510 | 733 |
| 26511 | 734 |
| 26512 | 741 |
| 26513 | 738 |
| 26514 | 745 |
| 26515 | 748 |
| 26516 | 760 |
| 26517 | 762 |
| 26518 | 764 |
| 26519 | 770 |
| 26520 | 799 |
| 26521 | 810 |
| 26522 | 837 |
| 26523 | 859 |
| 26524 | 896 |
| 26525 | 910 |
| 26526 | 936 |
| 26527 | 972 |
| 26528 | 1009 |
| 26529 | 1042 |
| 26530 | 1062 |
| 26531 | 1085 |
| 26532 | 1110 |
| 26533 | 1128 |
| 26534 | 1147 |
| 26535 | 1151 |
| 26536 | 1154 |
| 26537 | 1162 |
| 26538 | 1172 |
| 26539 | 1186 |
| 26540 | 1219 |
| 26541 | 1247 |
| 26542 | 1268 |
| 26543 | 1251 |
| 26544 | 1196 |
| 26545 | 1131 |
| 26546 | 1093 |
| 26547 | 1052 |
| 26548 | 1022 |
| 26549 | 961 |
| 26550 | 959 |
| 26551 | 947 |
| 26552 | 861 |
| 26553 | 770 |
| 26554 | 798 |
| 26555 | 754 |
| 26556 | 732 |
| 26557 | 739 |
| 26558 | 769 |
| 26559 | 818 |
| 26560 | 873 |
| 26561 | 953 |
| 26562 | 1009 |
| 26563 | 1050 |
| 26564 | 1132 |
| 26565 | 1215 |
| 26566 | 1290 |
| 26567 | 1355 |
| 26568 | 1433 |
| 26569 | 1505 |
| 26570 | 1593 |
| 26571 | 1685 |
| 26572 | 1728 |
| 26573 | 1757 |
| 26574 | 1759 |
| 26575 | 1739 |
| 26576 | 1704 |
| 26577 | 1646 |
| 26578 | 1576 |
| 26579 | 1519 |
| 26580 | 1482 |
| 26581 | 1443 |
| 26582 | 1409 |
| 26583 | 1378 |
| 26584 | 1305 |
| 26585 | 1238 |
| 26586 | 1161 |
| 26587 | 1098 |
| 26588 | 1027 |
| 26589 | 963 |
| 26590 | 907 |
| 26591 | 861 |
| 26592 | 858 |
| 26593 | 838 |
| 26594 | 813 |
| 26595 | 796 |
| 26596 | 777 |
| 26597 | 765 |
| 26598 | 750 |
| 26599 | 736 |
| 26600 | 729 |
| 26601 | 724 |
| 26602 | 718 |
| 26603 | 714 |
| 26604 | 713 |
| 26605 | 707 |
| 26606 | 705 |
| 26607 | 712 |
| 26608 | 750 |
| 26609 | 768 |
| 26610 | 790 |
| 26611 | 815 |
| 26612 | 869 |
| 26613 | 896 |
| 26614 | 949 |
| 26615 | 1024 |
| 26616 | 1159 |
| 26617 | 1251 |
| 26618 | 1330 |
| 26619 | 1407 |
| 26620 | 1484 |
| 26621 | 1506 |
| 26622 | 1509 |
| 26623 | 1536 |
| 26624 | 1555 |
| 26625 | 1566 |
| 26626 | 1569 |
| 26627 | 1544 |
| 26628 | 1501 |
| 26629 | 1468 |
| 26630 | 1440 |
| 26631 | 1410 |
| 26632 | 1406 |
| 26633 | 1406 |
| 26634 | 1414 |
| 26635 | 1400 |
| 26636 | 1405 |
| 26637 | 1413 |
| 26638 | 1422 |
| 26639 | 1425 |
| 26640 | 1381 |
| 26641 | 1313 |
| 26642 | 1266 |
| 26643 | 1242 |
| 26644 | 1261 |
| 26645 | 1228 |
| 26646 | 1169 |
| 26647 | 1116 |
| 26648 | 1105 |
| 26649 | 1070 |
| 26650 | 1098 |
| 26651 | 1084 |
| 26652 | 1074 |
| 26653 | 1128 |
| 26654 | 1186 |
| 26655 | 1173 |
| 26656 | 1199 |
| 26657 | 1236 |
| 26658 | 1232 |
| 26659 | 1296 |
| 26660 | 1350 |
| 26661 | 1407 |
| 26662 | 1502 |
| 26663 | 1579 |
| 26664 | 1630 |
| 26665 | 1680 |
| 26666 | 1741 |
| 26667 | 1812 |
| 26668 | 1897 |
| 26669 | 1952 |
| 26670 | 1974 |
| 26671 | 1948 |
| 26672 | 1907 |
| 26673 | 1835 |
| 26674 | 1763 |
| 26675 | 1704 |
| 26676 | 1650 |
| 26677 | 1587 |
| 26678 | 1545 |
| 26679 | 1496 |
| 26680 | 1415 |
| 26681 | 1332 |
| 26682 | 1252 |
| 26683 | 1171 |
| 26684 | 1090 |
| 26685 | 1028 |
| 26686 | 975 |
| 26687 | 933 |
| 26688 | 919 |
| 26689 | 899 |
| 26690 | 867 |
| 26691 | 844 |
| 26692 | 826 |
| 26693 | 805 |
| 26694 | 795 |
| 26695 | 784 |
| 26696 | 776 |
| 26697 | 770 |
| 26698 | 763 |
| 26699 | 759 |
| 26700 | 760 |
| 26701 | 759 |
| 26702 | 767 |
| 26703 | 771 |
| 26704 | 795 |
| 26705 | 807 |
| 26706 | 831 |
| 26707 | 856 |
| 26708 | 910 |
| 26709 | 938 |
| 26710 | 989 |
| 26711 | 1062 |
| 26712 | 1185 |
| 26713 | 1278 |
| 26714 | 1358 |
| 26715 | 1431 |
| 26716 | 1513 |
| 26717 | 1541 |
| 26718 | 1538 |
| 26719 | 1557 |
| 26720 | 1586 |
| 26721 | 1589 |
| 26722 | 1605 |
| 26723 | 1581 |
| 26724 | 1540 |
| 26725 | 1566 |
| 26726 | 1568 |
| 26727 | 1520 |
| 26728 | 1522 |
| 26729 | 1523 |
| 26730 | 1463 |
| 26731 | 1397 |
| 26732 | 1378 |
| 26733 | 1370 |
| 26734 | 1375 |
| 26735 | 1283 |
| 26736 | 1221 |
| 26737 | 1200 |
| 26738 | 1204 |
| 26739 | 1141 |
| 26740 | 1127 |
| 26741 | 1145 |
| 26742 | 1125 |
| 26743 | 1096 |
| 26744 | 1116 |
| 26745 | 1178 |
| 26746 | 1239 |
| 26747 | 1194 |
| 26748 | 1168 |
| 26749 | 1166 |
| 26750 | 1227 |
| 26751 | 1250 |
| 26752 | 1273 |
| 26753 | 1283 |
| 26754 | 1332 |
| 26755 | 1352 |
| 26756 | 1421 |
| 26757 | 1489 |
| 26758 | 1565 |
| 26759 | 1644 |
| 26760 | 1714 |
| 26761 | 1769 |
| 26762 | 1827 |
| 26763 | 1921 |
| 26764 | 1947 |
| 26765 | 1965 |
| 26766 | 1973 |
| 26767 | 1953 |
| 26768 | 1904 |
| 26769 | 1843 |
| 26770 | 1777 |
| 26771 | 1727 |
| 26772 | 1672 |
| 26773 | 1619 |
| 26774 | 1589 |
| 26775 | 1542 |
| 26776 | 1444 |
| 26777 | 1371 |
| 26778 | 1297 |
| 26779 | 1207 |
| 26780 | 1117 |
| 26781 | 1052 |
| 26782 | 991 |
| 26783 | 947 |
| 26784 | 936 |
| 26785 | 912 |
| 26786 | 880 |
| 26787 | 851 |
| 26788 | 825 |
| 26789 | 799 |
| 26790 | 783 |
| 26791 | 769 |
| 26792 | 764 |
| 26793 | 753 |
| 26794 | 743 |
| 26795 | 744 |
| 26796 | 735 |
| 26797 | 730 |
| 26798 | 732 |
| 26799 | 738 |
| 26800 | 760 |
| 26801 | 766 |
| 26802 | 795 |
| 26803 | 822 |
| 26804 | 875 |
| 26805 | 906 |
| 26806 | 964 |
| 26807 | 1024 |
| 26808 | 1150 |
| 26809 | 1228 |
| 26810 | 1304 |
| 26811 | 1381 |
| 26812 | 1462 |
| 26813 | 1504 |
| 26814 | 1508 |
| 26815 | 1528 |
| 26816 | 1543 |
| 26817 | 1576 |
| 26818 | 1591 |
| 26819 | 1585 |
| 26820 | 1550 |
| 26821 | 1534 |
| 26822 | 1578 |
| 26823 | 1604 |
| 26824 | 1619 |
| 26825 | 1618 |
| 26826 | 1568 |
| 26827 | 1574 |
| 26828 | 1587 |
| 26829 | 1606 |
| 26830 | 1588 |
| 26831 | 1580 |
| 26832 | 1593 |
| 26833 | 1596 |
| 26834 | 1532 |
| 26835 | 1510 |
| 26836 | 1518 |
| 26837 | 1525 |
| 26838 | 1513 |
| 26839 | 1472 |
| 26840 | 1447 |
| 26841 | 1436 |
| 26842 | 1455 |
| 26843 | 1433 |
| 26844 | 1440 |
| 26845 | 1433 |
| 26846 | 1408 |
| 26847 | 1379 |
| 26848 | 1403 |
| 26849 | 1465 |
| 26850 | 1520 |
| 26851 | 1553 |
| 26852 | 1581 |
| 26853 | 1642 |
| 26854 | 1686 |
| 26855 | 1750 |
| 26856 | 1788 |
| 26857 | 1830 |
| 26858 | 1883 |
| 26859 | 1966 |
| 26860 | 2009 |
| 26861 | 2014 |
| 26862 | 2005 |
| 26863 | 1974 |
| 26864 | 1928 |
| 26865 | 1864 |
| 26866 | 1793 |
| 26867 | 1724 |
| 26868 | 1664 |
| 26869 | 1620 |
| 26870 | 1589 |
| 26871 | 1536 |
| 26872 | 1436 |
| 26873 | 1361 |
| 26874 | 1294 |
| 26875 | 1210 |
| 26876 | 1126 |
| 26877 | 1056 |
| 26878 | 1002 |
| 26879 | 956 |
| 26880 | 947 |
| 26881 | 922 |
| 26882 | 892 |
| 26883 | 871 |
| 26884 | 844 |
| 26885 | 820 |
| 26886 | 807 |
| 26887 | 793 |
| 26888 | 785 |
| 26889 | 775 |
| 26890 | 769 |
| 26891 | 770 |
| 26892 | 769 |
| 26893 | 767 |
| 26894 | 769 |
| 26895 | 776 |
| 26896 | 795 |
| 26897 | 809 |
| 26898 | 828 |
| 26899 | 857 |
| 26900 | 903 |
| 26901 | 922 |
| 26902 | 975 |
| 26903 | 1061 |
| 26904 | 1178 |
| 26905 | 1263 |
| 26906 | 1342 |
| 26907 | 1410 |
| 26908 | 1495 |
| 26909 | 1552 |
| 26910 | 1569 |
| 26911 | 1583 |
| 26912 | 1618 |
| 26913 | 1636 |
| 26914 | 1641 |
| 26915 | 1616 |
| 26916 | 1564 |
| 26917 | 1548 |
| 26918 | 1509 |
| 26919 | 1419 |
| 26920 | 1366 |
| 26921 | 1374 |
| 26922 | 1396 |
| 26923 | 1453 |
| 26924 | 1500 |
| 26925 | 1561 |
| 26926 | 1616 |
| 26927 | 1629 |
| 26928 | 1589 |
| 26929 | 1592 |
| 26930 | 1468 |
| 26931 | 1406 |
| 26932 | 1365 |
| 26933 | 1292 |
| 26934 | 1284 |
| 26935 | 1352 |
| 26936 | 1389 |
| 26937 | 1365 |
| 26938 | 1348 |
| 26939 | 1315 |
| 26940 | 1304 |
| 26941 | 1365 |
| 26942 | 1365 |
| 26943 | 1391 |
| 26944 | 1432 |
| 26945 | 1452 |
| 26946 | 1488 |
| 26947 | 1497 |
| 26948 | 1516 |
| 26949 | 1586 |
| 26950 | 1650 |
| 26951 | 1709 |
| 26952 | 1748 |
| 26953 | 1802 |
| 26954 | 1864 |
| 26955 | 1945 |
| 26956 | 1982 |
| 26957 | 1970 |
| 26958 | 1951 |
| 26959 | 1925 |
| 26960 | 1880 |
| 26961 | 1815 |
| 26962 | 1745 |
| 26963 | 1701 |
| 26964 | 1645 |
| 26965 | 1596 |
| 26966 | 1568 |
| 26967 | 1536 |
| 26968 | 1473 |
| 26969 | 1409 |
| 26970 | 1346 |
| 26971 | 1280 |
| 26972 | 1218 |
| 26973 | 1157 |
| 26974 | 1100 |
| 26975 | 1051 |
| 26976 | 1029 |
| 26977 | 1000 |
| 26978 | 966 |
| 26979 | 933 |
| 26980 | 911 |
| 26981 | 882 |
| 26982 | 862 |
| 26983 | 843 |
| 26984 | 833 |
| 26985 | 818 |
| 26986 | 809 |
| 26987 | 806 |
| 26988 | 802 |
| 26989 | 791 |
| 26990 | 780 |
| 26991 | 777 |
| 26992 | 791 |
| 26993 | 796 |
| 26994 | 804 |
| 26995 | 809 |
| 26996 | 824 |
| 26997 | 825 |
| 26998 | 841 |
| 26999 | 866 |
| 27000 | 943 |
| 27001 | 973 |
| 27002 | 1012 |
| 27003 | 1054 |
| 27004 | 1108 |
| 27005 | 1154 |
| 27006 | 1174 |
| 27007 | 1222 |
| 27008 | 1269 |
| 27009 | 1299 |
| 27010 | 1335 |
| 27011 | 1366 |
| 27012 | 1400 |
| 27013 | 1389 |
| 27014 | 1423 |
| 27015 | 1451 |
| 27016 | 1477 |
| 27017 | 1475 |
| 27018 | 1466 |
| 27019 | 1470 |
| 27020 | 1477 |
| 27021 | 1435 |
| 27022 | 1366 |
| 27023 | 1287 |
| 27024 | 1225 |
| 27025 | 1218 |
| 27026 | 1228 |
| 27027 | 1191 |
| 27028 | 1137 |
| 27029 | 1108 |
| 27030 | 1102 |
| 27031 | 1104 |
| 27032 | 1110 |
| 27033 | 1102 |
| 27034 | 1101 |
| 27035 | 1110 |
| 27036 | 1122 |
| 27037 | 1122 |
| 27038 | 1126 |
| 27039 | 1162 |
| 27040 | 1166 |
| 27041 | 1203 |
| 27042 | 1258 |
| 27043 | 1298 |
| 27044 | 1352 |
| 27045 | 1385 |
| 27046 | 1441 |
| 27047 | 1504 |
| 27048 | 1577 |
| 27049 | 1625 |
| 27050 | 1694 |
| 27051 | 1784 |
| 27052 | 1850 |
| 27053 | 1858 |
| 27054 | 1851 |
| 27055 | 1831 |
| 27056 | 1779 |
| 27057 | 1701 |
| 27058 | 1632 |
| 27059 | 1586 |
| 27060 | 1551 |
| 27061 | 1500 |
| 27062 | 1491 |
| 27063 | 1459 |
| 27064 | 1397 |
| 27065 | 1344 |
| 27066 | 1288 |
| 27067 | 1237 |
| 27068 | 1163 |
| 27069 | 1106 |
| 27070 | 1053 |
| 27071 | 1003 |
| 27072 | 970 |
| 27073 | 949 |
| 27074 | 917 |
| 27075 | 885 |
| 27076 | 858 |
| 27077 | 835 |
| 27078 | 813 |
| 27079 | 797 |
| 27080 | 783 |
| 27081 | 768 |
| 27082 | 755 |
| 27083 | 748 |
| 27084 | 741 |
| 27085 | 737 |
| 27086 | 735 |
| 27087 | 736 |
| 27088 | 743 |
| 27089 | 739 |
| 27090 | 748 |
| 27091 | 751 |
| 27092 | 762 |
| 27093 | 765 |
| 27094 | 767 |
| 27095 | 771 |
| 27096 | 801 |
| 27097 | 813 |
| 27098 | 840 |
| 27099 | 863 |
| 27100 | 909 |
| 27101 | 925 |
| 27102 | 946 |
| 27103 | 983 |
| 27104 | 1029 |
| 27105 | 1070 |
| 27106 | 1093 |
| 27107 | 1111 |
| 27108 | 1137 |
| 27109 | 1151 |
| 27110 | 1180 |
| 27111 | 1190 |
| 27112 | 1195 |
| 27113 | 1198 |
| 27114 | 1205 |
| 27115 | 1223 |
| 27116 | 1261 |
| 27117 | 1275 |
| 27118 | 1294 |
| 27119 | 1271 |
| 27120 | 1209 |
| 27121 | 1135 |
| 27122 | 1098 |
| 27123 | 1045 |
| 27124 | 1013 |
| 27125 | 949 |
| 27126 | 946 |
| 27127 | 930 |
| 27128 | 842 |
| 27129 | 752 |
| 27130 | 765 |
| 27131 | 715 |
| 27132 | 698 |
| 27133 | 703 |
| 27134 | 732 |
| 27135 | 782 |
| 27136 | 839 |
| 27137 | 924 |
| 27138 | 987 |
| 27139 | 1039 |
| 27140 | 1129 |
| 27141 | 1225 |
| 27142 | 1313 |
| 27143 | 1389 |
| 27144 | 1471 |
| 27145 | 1539 |
| 27146 | 1628 |
| 27147 | 1730 |
| 27148 | 1766 |
| 27149 | 1781 |
| 27150 | 1761 |
| 27151 | 1733 |
| 27152 | 1695 |
| 27153 | 1639 |
| 27154 | 1568 |
| 27155 | 1508 |
| 27156 | 1468 |
| 27157 | 1429 |
| 27158 | 1397 |
| 27159 | 1362 |
| 27160 | 1289 |
| 27161 | 1222 |
| 27162 | 1145 |
| 27163 | 1079 |
| 27164 | 1008 |
| 27165 | 944 |
| 27166 | 891 |
| 27167 | 846 |
| 27168 | 834 |
| 27169 | 816 |
| 27170 | 786 |
| 27171 | 765 |
| 27172 | 746 |
| 27173 | 734 |
| 27174 | 726 |
| 27175 | 717 |
| 27176 | 713 |
| 27177 | 704 |
| 27178 | 691 |
| 27179 | 687 |
| 27180 | 690 |
| 27181 | 690 |
| 27182 | 688 |
| 27183 | 692 |
| 27184 | 725 |
| 27185 | 736 |
| 27186 | 762 |
| 27187 | 784 |
| 27188 | 838 |
| 27189 | 862 |
| 27190 | 921 |
| 27191 | 988 |
| 27192 | 1111 |
| 27193 | 1202 |
| 27194 | 1275 |
| 27195 | 1345 |
| 27196 | 1447 |
| 27197 | 1483 |
| 27198 | 1507 |
| 27199 | 1526 |
| 27200 | 1564 |
| 27201 | 1585 |
| 27202 | 1607 |
| 27203 | 1611 |
| 27204 | 1597 |
| 27205 | 1584 |
| 27206 | 1566 |
| 27207 | 1528 |
| 27208 | 1530 |
| 27209 | 1521 |
| 27210 | 1536 |
| 27211 | 1547 |
| 27212 | 1570 |
| 27213 | 1581 |
| 27214 | 1557 |
| 27215 | 1564 |
| 27216 | 1516 |
| 27217 | 1413 |
| 27218 | 1357 |
| 27219 | 1351 |
| 27220 | 1350 |
| 27221 | 1271 |
| 27222 | 1240 |
| 27223 | 1238 |
| 27224 | 1265 |
| 27225 | 1237 |
| 27226 | 1269 |
| 27227 | 1266 |
| 27228 | 1274 |
| 27229 | 1292 |
| 27230 | 1335 |
| 27231 | 1335 |
| 27232 | 1370 |
| 27233 | 1364 |
| 27234 | 1348 |
| 27235 | 1405 |
| 27236 | 1456 |
| 27237 | 1501 |
| 27238 | 1584 |
| 27239 | 1664 |
| 27240 | 1720 |
| 27241 | 1774 |
| 27242 | 1852 |
| 27243 | 1936 |
| 27244 | 1995 |
| 27245 | 2016 |
| 27246 | 1998 |
| 27247 | 1962 |
| 27248 | 1916 |
| 27249 | 1837 |
| 27250 | 1772 |
| 27251 | 1714 |
| 27252 | 1663 |
| 27253 | 1598 |
| 27254 | 1563 |
| 27255 | 1514 |
| 27256 | 1434 |
| 27257 | 1355 |
| 27258 | 1274 |
| 27259 | 1192 |
| 27260 | 1109 |
| 27261 | 1045 |
| 27262 | 989 |
| 27263 | 947 |
| 27264 | 944 |
| 27265 | 928 |
| 27266 | 894 |
| 27267 | 867 |
| 27268 | 847 |
| 27269 | 830 |
| 27270 | 814 |
| 27271 | 798 |
| 27272 | 791 |
| 27273 | 779 |
| 27274 | 771 |
| 27275 | 769 |
| 27276 | 762 |
| 27277 | 759 |
| 27278 | 760 |
| 27279 | 766 |
| 27280 | 789 |
| 27281 | 804 |
| 27282 | 829 |
| 27283 | 859 |
| 27284 | 903 |
| 27285 | 932 |
| 27286 | 984 |
| 27287 | 1051 |
| 27288 | 1166 |
| 27289 | 1241 |
| 27290 | 1314 |
| 27291 | 1383 |
| 27292 | 1479 |
| 27293 | 1549 |
| 27294 | 1560 |
| 27295 | 1560 |
| 27296 | 1596 |
| 27297 | 1605 |
| 27298 | 1611 |
| 27299 | 1601 |
| 27300 | 1541 |
| 27301 | 1486 |
| 27302 | 1496 |
| 27303 | 1499 |
| 27304 | 1478 |
| 27305 | 1503 |
| 27306 | 1496 |
| 27307 | 1455 |
| 27308 | 1449 |
| 27309 | 1478 |
| 27310 | 1580 |
| 27311 | 1582 |
| 27312 | 1553 |
| 27313 | 1545 |
| 27314 | 1491 |
| 27315 | 1463 |
| 27316 | 1290 |
| 27317 | 1376 |
| 27318 | 1417 |
| 27319 | 1368 |
| 27320 | 1314 |
| 27321 | 1299 |
| 27322 | 1304 |
| 27323 | 1347 |
| 27324 | 1372 |
| 27325 | 1361 |
| 27326 | 1353 |
| 27327 | 1349 |
| 27328 | 1377 |
| 27329 | 1373 |
| 27330 | 1401 |
| 27331 | 1427 |
| 27332 | 1493 |
| 27333 | 1591 |
| 27334 | 1650 |
| 27335 | 1705 |
| 27336 | 1737 |
| 27337 | 1799 |
| 27338 | 1879 |
| 27339 | 1943 |
| 27340 | 2015 |
| 27341 | 1985 |
| 27342 | 1955 |
| 27343 | 1922 |
| 27344 | 1867 |
| 27345 | 1790 |
| 27346 | 1727 |
| 27347 | 1670 |
| 27348 | 1630 |
| 27349 | 1577 |
| 27350 | 1552 |
| 27351 | 1510 |
| 27352 | 1428 |
| 27353 | 1354 |
| 27354 | 1281 |
| 27355 | 1197 |
| 27356 | 1111 |
| 27357 | 1036 |
| 27358 | 973 |
| 27359 | 922 |
| 27360 | 908 |
| 27361 | 892 |
| 27362 | 865 |
| 27363 | 846 |
| 27364 | 818 |
| 27365 | 793 |
| 27366 | 778 |
| 27367 | 768 |
| 27368 | 758 |
| 27369 | 754 |
| 27370 | 758 |
| 27371 | 755 |
| 27372 | 760 |
| 27373 | 758 |
| 27374 | 754 |
| 27375 | 756 |
| 27376 | 774 |
| 27377 | 787 |
| 27378 | 811 |
| 27379 | 829 |
| 27380 | 884 |
| 27381 | 914 |
| 27382 | 962 |
| 27383 | 1033 |
| 27384 | 1152 |
| 27385 | 1230 |
| 27386 | 1303 |
| 27387 | 1376 |
| 27388 | 1478 |
| 27389 | 1527 |
| 27390 | 1538 |
| 27391 | 1555 |
| 27392 | 1580 |
| 27393 | 1595 |
| 27394 | 1610 |
| 27395 | 1585 |
| 27396 | 1539 |
| 27397 | 1582 |
| 27398 | 1600 |
| 27399 | 1553 |
| 27400 | 1565 |
| 27401 | 1578 |
| 27402 | 1519 |
| 27403 | 1464 |
| 27404 | 1489 |
| 27405 | 1530 |
| 27406 | 1588 |
| 27407 | 1527 |
| 27408 | 1514 |
| 27409 | 1501 |
| 27410 | 1489 |
| 27411 | 1424 |
| 27412 | 1415 |
| 27413 | 1451 |
| 27414 | 1439 |
| 27415 | 1417 |
| 27416 | 1422 |
| 27417 | 1474 |
| 27418 | 1525 |
| 27419 | 1472 |
| 27420 | 1434 |
| 27421 | 1426 |
| 27422 | 1482 |
| 27423 | 1490 |
| 27424 | 1499 |
| 27425 | 1505 |
| 27426 | 1534 |
| 27427 | 1543 |
| 27428 | 1589 |
| 27429 | 1634 |
| 27430 | 1688 |
| 27431 | 1746 |
| 27432 | 1809 |
| 27433 | 1876 |
| 27434 | 1939 |
| 27435 | 2026 |
| 27436 | 2031 |
| 27437 | 1997 |
| 27438 | 1972 |
| 27439 | 1947 |
| 27440 | 1900 |
| 27441 | 1828 |
| 27442 | 1771 |
| 27443 | 1718 |
| 27444 | 1668 |
| 27445 | 1619 |
| 27446 | 1610 |
| 27447 | 1568 |
| 27448 | 1462 |
| 27449 | 1382 |
| 27450 | 1305 |
| 27451 | 1218 |
| 27452 | 1129 |
| 27453 | 1064 |
| 27454 | 1007 |
| 27455 | 962 |
| 27456 | 952 |
| 27457 | 932 |
| 27458 | 896 |
| 27459 | 873 |
| 27460 | 851 |
| 27461 | 830 |
| 27462 | 813 |
| 27463 | 795 |
| 27464 | 788 |
| 27465 | 780 |
| 27466 | 763 |
| 27467 | 760 |
| 27468 | 752 |
| 27469 | 748 |
| 27470 | 749 |
| 27471 | 757 |
| 27472 | 775 |
| 27473 | 789 |
| 27474 | 819 |
| 27475 | 852 |
| 27476 | 900 |
| 27477 | 927 |
| 27478 | 977 |
| 27479 | 1034 |
| 27480 | 1156 |
| 27481 | 1229 |
| 27482 | 1294 |
| 27483 | 1374 |
| 27484 | 1468 |
| 27485 | 1519 |
| 27486 | 1542 |
| 27487 | 1543 |
| 27488 | 1570 |
| 27489 | 1597 |
| 27490 | 1610 |
| 27491 | 1608 |
| 27492 | 1571 |
| 27493 | 1548 |
| 27494 | 1552 |
| 27495 | 1536 |
| 27496 | 1515 |
| 27497 | 1493 |
| 27498 | 1435 |
| 27499 | 1427 |
| 27500 | 1429 |
| 27501 | 1450 |
| 27502 | 1481 |
| 27503 | 1468 |
| 27504 | 1487 |
| 27505 | 1497 |
| 27506 | 1438 |
| 27507 | 1417 |
| 27508 | 1424 |
| 27509 | 1436 |
| 27510 | 1424 |
| 27511 | 1391 |
| 27512 | 1342 |
| 27513 | 1354 |
| 27514 | 1361 |
| 27515 | 1332 |
| 27516 | 1365 |
| 27517 | 1354 |
| 27518 | 1340 |
| 27519 | 1353 |
| 27520 | 1418 |
| 27521 | 1480 |
| 27522 | 1533 |
| 27523 | 1582 |
| 27524 | 1622 |
| 27525 | 1690 |
| 27526 | 1741 |
| 27527 | 1804 |
| 27528 | 1836 |
| 27529 | 1887 |
| 27530 | 1956 |
| 27531 | 2050 |
| 27532 | 2081 |
| 27533 | 2066 |
| 27534 | 2033 |
| 27535 | 1993 |
| 27536 | 1940 |
| 27537 | 1878 |
| 27538 | 1808 |
| 27539 | 1743 |
| 27540 | 1688 |
| 27541 | 1640 |
| 27542 | 1610 |
| 27543 | 1567 |
| 27544 | 1473 |
| 27545 | 1398 |
| 27546 | 1334 |
| 27547 | 1250 |
| 27548 | 1166 |
| 27549 | 1095 |
| 27550 | 1037 |
| 27551 | 989 |
| 27552 | 987 |
| 27553 | 967 |
| 27554 | 936 |
| 27555 | 912 |
| 27556 | 885 |
| 27557 | 860 |
| 27558 | 845 |
| 27559 | 827 |
| 27560 | 817 |
| 27561 | 807 |
| 27562 | 802 |
| 27563 | 799 |
| 27564 | 800 |
| 27565 | 795 |
| 27566 | 797 |
| 27567 | 803 |
| 27568 | 823 |
| 27569 | 837 |
| 27570 | 854 |
| 27571 | 881 |
| 27572 | 929 |
| 27573 | 944 |
| 27574 | 992 |
| 27575 | 1064 |
| 27576 | 1180 |
| 27577 | 1255 |
| 27578 | 1329 |
| 27579 | 1397 |
| 27580 | 1493 |
| 27581 | 1563 |
| 27582 | 1597 |
| 27583 | 1605 |
| 27584 | 1646 |
| 27585 | 1668 |
| 27586 | 1665 |
| 27587 | 1634 |
| 27588 | 1577 |
| 27589 | 1561 |
| 27590 | 1534 |
| 27591 | 1462 |
| 27592 | 1430 |
| 27593 | 1435 |
| 27594 | 1442 |
| 27595 | 1464 |
| 27596 | 1474 |
| 27597 | 1496 |
| 27598 | 1508 |
| 27599 | 1509 |
| 27600 | 1463 |
| 27601 | 1429 |
| 27602 | 1317 |
| 27603 | 1259 |
| 27604 | 1215 |
| 27605 | 1166 |
| 27606 | 1162 |
| 27607 | 1206 |
| 27608 | 1227 |
| 27609 | 1205 |
| 27610 | 1209 |
| 27611 | 1187 |
| 27612 | 1187 |
| 27613 | 1246 |
| 27614 | 1251 |
| 27615 | 1275 |
| 27616 | 1325 |
| 27617 | 1399 |
| 27618 | 1472 |
| 27619 | 1500 |
| 27620 | 1533 |
| 27621 | 1607 |
| 27622 | 1682 |
| 27623 | 1747 |
| 27624 | 1803 |
| 27625 | 1868 |
| 27626 | 1948 |
| 27627 | 2035 |
| 27628 | 2050 |
| 27629 | 2017 |
| 27630 | 1980 |
| 27631 | 1949 |
| 27632 | 1901 |
| 27633 | 1828 |
| 27634 | 1756 |
| 27635 | 1712 |
| 27636 | 1663 |
| 27637 | 1615 |
| 27638 | 1592 |
| 27639 | 1563 |
| 27640 | 1503 |
| 27641 | 1440 |
| 27642 | 1372 |
| 27643 | 1305 |
| 27644 | 1240 |
| 27645 | 1179 |
| 27646 | 1120 |
| 27647 | 1064 |
| 27648 | 1051 |
| 27649 | 1030 |
| 27650 | 994 |
| 27651 | 960 |
| 27652 | 938 |
| 27653 | 910 |
| 27654 | 886 |
| 27655 | 864 |
| 27656 | 852 |
| 27657 | 834 |
| 27658 | 824 |
| 27659 | 821 |
| 27660 | 818 |
| 27661 | 809 |
| 27662 | 800 |
| 27663 | 795 |
| 27664 | 808 |
| 27665 | 812 |
| 27666 | 818 |
| 27667 | 825 |
| 27668 | 844 |
| 27669 | 843 |
| 27670 | 859 |
| 27671 | 880 |
| 27672 | 956 |
| 27673 | 989 |
| 27674 | 1032 |
| 27675 | 1073 |
| 27676 | 1133 |
| 27677 | 1183 |
| 27678 | 1214 |
| 27679 | 1260 |
| 27680 | 1302 |
| 27681 | 1336 |
| 27682 | 1373 |
| 27683 | 1403 |
| 27684 | 1439 |
| 27685 | 1435 |
| 27686 | 1471 |
| 27687 | 1500 |
| 27688 | 1522 |
| 27689 | 1525 |
| 27690 | 1522 |
| 27691 | 1521 |
| 27692 | 1514 |
| 27693 | 1472 |
| 27694 | 1414 |
| 27695 | 1355 |
| 27696 | 1294 |
| 27697 | 1278 |
| 27698 | 1268 |
| 27699 | 1244 |
| 27700 | 1210 |
| 27701 | 1198 |
| 27702 | 1199 |
| 27703 | 1209 |
| 27704 | 1216 |
| 27705 | 1206 |
| 27706 | 1207 |
| 27707 | 1209 |
| 27708 | 1222 |
| 27709 | 1227 |
| 27710 | 1232 |
| 27711 | 1249 |
| 27712 | 1267 |
| 27713 | 1296 |
| 27714 | 1347 |
| 27715 | 1395 |
| 27716 | 1452 |
| 27717 | 1501 |
| 27718 | 1570 |
| 27719 | 1635 |
| 27720 | 1699 |
| 27721 | 1756 |
| 27722 | 1832 |
| 27723 | 1907 |
| 27724 | 1937 |
| 27725 | 1918 |
| 27726 | 1876 |
| 27727 | 1846 |
| 27728 | 1794 |
| 27729 | 1717 |
| 27730 | 1652 |
| 27731 | 1606 |
| 27732 | 1571 |
| 27733 | 1520 |
| 27734 | 1509 |
| 27735 | 1485 |
| 27736 | 1424 |
| 27737 | 1374 |
| 27738 | 1316 |
| 27739 | 1264 |
| 27740 | 1195 |
| 27741 | 1138 |
| 27742 | 1084 |
| 27743 | 1034 |
| 27744 | 980 |
| 27745 | 959 |
| 27746 | 923 |
| 27747 | 889 |
| 27748 | 861 |
| 27749 | 838 |
| 27750 | 818 |
| 27751 | 799 |
| 27752 | 788 |
| 27753 | 772 |
| 27754 | 759 |
| 27755 | 751 |
| 27756 | 747 |
| 27757 | 745 |
| 27758 | 744 |
| 27759 | 743 |
| 27760 | 748 |
| 27761 | 746 |
| 27762 | 755 |
| 27763 | 757 |
| 27764 | 769 |
| 27765 | 770 |
| 27766 | 772 |
| 27767 | 773 |
| 27768 | 808 |
| 27769 | 819 |
| 27770 | 845 |
| 27771 | 867 |
| 27772 | 917 |
| 27773 | 948 |
| 27774 | 957 |
| 27775 | 995 |
| 27776 | 1045 |
| 27777 | 1097 |
| 27778 | 1123 |
| 27779 | 1133 |
| 27780 | 1143 |
| 27781 | 1136 |
| 27782 | 1160 |
| 27783 | 1153 |
| 27784 | 1124 |
| 27785 | 1105 |
| 27786 | 1094 |
| 27787 | 1102 |
| 27788 | 1137 |
| 27789 | 1118 |
| 27790 | 1110 |
| 27791 | 1052 |
| 27792 | 957 |
| 27793 | 867 |
| 27794 | 821 |
| 27795 | 757 |
| 27796 | 734 |
| 27797 | 670 |
| 27798 | 673 |
| 27799 | 664 |
| 27800 | 577 |
| 27801 | 498 |
| 27802 | 518 |
| 27803 | 488 |
| 27804 | 496 |
| 27805 | 530 |
| 27806 | 581 |
| 27807 | 656 |
| 27808 | 724 |
| 27809 | 821 |
| 27810 | 903 |
| 27811 | 982 |
| 27812 | 1079 |
| 27813 | 1188 |
| 27814 | 1283 |
| 27815 | 1373 |
| 27816 | 1462 |
| 27817 | 1531 |
| 27818 | 1628 |
| 27819 | 1758 |
| 27820 | 1772 |
| 27821 | 1760 |
| 27822 | 1735 |
| 27823 | 1703 |
| 27824 | 1668 |
| 27825 | 1616 |
| 27826 | 1538 |
| 27827 | 1475 |
| 27828 | 1424 |
| 27829 | 1385 |
| 27830 | 1362 |
| 27831 | 1317 |
| 27832 | 1245 |
| 27833 | 1179 |
| 27834 | 1101 |
| 27835 | 1031 |
| 27836 | 961 |
| 27837 | 897 |
| 27838 | 850 |
| 27839 | 808 |
| 27840 | 800 |
| 27841 | 778 |
| 27842 | 742 |
| 27843 | 720 |
| 27844 | 703 |
| 27845 | 692 |
| 27846 | 692 |
| 27847 | 690 |
| 27848 | 691 |
| 27849 | 681 |
| 27850 | 660 |
| 27851 | 653 |
| 27852 | 660 |
| 27853 | 665 |
| 27854 | 666 |
| 27855 | 668 |
| 27856 | 693 |
| 27857 | 702 |
| 27858 | 728 |
| 27859 | 746 |
| 27860 | 799 |
| 27861 | 825 |
| 27862 | 890 |
| 27863 | 948 |
| 27864 | 1060 |
| 27865 | 1148 |
| 27866 | 1209 |
| 27867 | 1276 |
| 27868 | 1385 |
| 27869 | 1440 |
| 27870 | 1486 |
| 27871 | 1488 |
| 27872 | 1540 |
| 27873 | 1564 |
| 27874 | 1589 |
| 27875 | 1607 |
| 27876 | 1609 |
| 27877 | 1601 |
| 27878 | 1634 |
| 27879 | 1624 |
| 27880 | 1631 |
| 27881 | 1611 |
| 27882 | 1645 |
| 27883 | 1664 |
| 27884 | 1696 |
| 27885 | 1722 |
| 27886 | 1682 |
| 27887 | 1668 |
| 27888 | 1577 |
| 27889 | 1446 |
| 27890 | 1363 |
| 27891 | 1341 |
| 27892 | 1290 |
| 27893 | 1149 |
| 27894 | 1152 |
| 27895 | 1250 |
| 27896 | 1317 |
| 27897 | 1321 |
| 27898 | 1373 |
| 27899 | 1377 |
| 27900 | 1399 |
| 27901 | 1394 |
| 27902 | 1433 |
| 27903 | 1423 |
| 27904 | 1459 |
| 27905 | 1452 |
| 27906 | 1444 |
| 27907 | 1508 |
| 27908 | 1553 |
| 27909 | 1579 |
| 27910 | 1655 |
| 27911 | 1728 |
| 27912 | 1779 |
| 27913 | 1834 |
| 27914 | 1927 |
| 27915 | 2011 |
| 27916 | 2043 |
| 27917 | 2028 |
| 27918 | 1991 |
| 27919 | 1952 |
| 27920 | 1903 |
| 27921 | 1822 |
| 27922 | 1759 |
| 27923 | 1704 |
| 27924 | 1658 |
| 27925 | 1597 |
| 27926 | 1562 |
| 27927 | 1514 |
| 27928 | 1438 |
| 27929 | 1359 |
| 27930 | 1281 |
| 27931 | 1201 |
| 27932 | 1117 |
| 27933 | 1052 |
| 27934 | 995 |
| 27935 | 953 |
| 27936 | 955 |
| 27937 | 938 |
| 27938 | 905 |
| 27939 | 881 |
| 27940 | 860 |
| 27941 | 839 |
| 27942 | 819 |
| 27943 | 805 |
| 27944 | 795 |
| 27945 | 781 |
| 27946 | 780 |
| 27947 | 772 |
| 27948 | 763 |
| 27949 | 758 |
| 27950 | 760 |
| 27951 | 771 |
| 27952 | 793 |
| 27953 | 812 |
| 27954 | 835 |
| 27955 | 869 |
| 27956 | 909 |
| 27957 | 935 |
| 27958 | 981 |
| 27959 | 1041 |
| 27960 | 1150 |
| 27961 | 1210 |
| 27962 | 1281 |
| 27963 | 1350 |
| 27964 | 1440 |
| 27965 | 1520 |
| 27966 | 1544 |
| 27967 | 1546 |
| 27968 | 1578 |
| 27969 | 1594 |
| 27970 | 1602 |
| 27971 | 1569 |
| 27972 | 1507 |
| 27973 | 1456 |
| 27974 | 1462 |
| 27975 | 1487 |
| 27976 | 1449 |
| 27977 | 1452 |
| 27978 | 1453 |
| 27979 | 1416 |
| 27980 | 1439 |
| 27981 | 1553 |
| 27982 | 1597 |
| 27983 | 1530 |
| 27984 | 1473 |
| 27985 | 1460 |
| 27986 | 1394 |
| 27987 | 1393 |
| 27988 | 1410 |
| 27989 | 1368 |
| 27990 | 1413 |
| 27991 | 1350 |
| 27992 | 1279 |
| 27993 | 1271 |
| 27994 | 1279 |
| 27995 | 1363 |
| 27996 | 1414 |
| 27997 | 1414 |
| 27998 | 1393 |
| 27999 | 1387 |
| 28000 | 1416 |
| 28001 | 1427 |
| 28002 | 1458 |
| 28003 | 1460 |
| 28004 | 1533 |
| 28005 | 1645 |
| 28006 | 1708 |
| 28007 | 1757 |
| 28008 | 1785 |
| 28009 | 1853 |
| 28010 | 1943 |
| 28011 | 2011 |
| 28012 | 2067 |
| 28013 | 1991 |
| 28014 | 1952 |
| 28015 | 1911 |
| 28016 | 1850 |
| 28017 | 1771 |
| 28018 | 1713 |
| 28019 | 1653 |
| 28020 | 1603 |
| 28021 | 1545 |
| 28022 | 1531 |
| 28023 | 1481 |
| 28024 | 1393 |
| 28025 | 1323 |
| 28026 | 1249 |
| 28027 | 1174 |
| 28028 | 1091 |
| 28029 | 1023 |
| 28030 | 961 |
| 28031 | 910 |
| 28032 | 900 |
| 28033 | 887 |
| 28034 | 863 |
| 28035 | 852 |
| 28036 | 815 |
| 28037 | 788 |
| 28038 | 767 |
| 28039 | 758 |
| 28040 | 744 |
| 28041 | 742 |
| 28042 | 758 |
| 28043 | 756 |
| 28044 | 764 |
| 28045 | 757 |
| 28046 | 741 |
| 28047 | 741 |
| 28048 | 756 |
| 28049 | 770 |
| 28050 | 787 |
| 28051 | 797 |
| 28052 | 852 |
| 28053 | 885 |
| 28054 | 928 |
| 28055 | 994 |
| 28056 | 1107 |
| 28057 | 1172 |
| 28058 | 1237 |
| 28059 | 1312 |
| 28060 | 1422 |
| 28061 | 1490 |
| 28062 | 1526 |
| 28063 | 1546 |
| 28064 | 1573 |
| 28065 | 1603 |
| 28066 | 1617 |
| 28067 | 1584 |
| 28068 | 1538 |
| 28069 | 1593 |
| 28070 | 1621 |
| 28071 | 1561 |
| 28072 | 1575 |
| 28073 | 1584 |
| 28074 | 1511 |
| 28075 | 1445 |
| 28076 | 1503 |
| 28077 | 1552 |
| 28078 | 1596 |
| 28079 | 1526 |
| 28080 | 1554 |
| 28081 | 1547 |
| 28082 | 1481 |
| 28083 | 1401 |
| 28084 | 1386 |
| 28085 | 1426 |
| 28086 | 1443 |
| 28087 | 1440 |
| 28088 | 1447 |
| 28089 | 1482 |
| 28090 | 1532 |
| 28091 | 1522 |
| 28092 | 1515 |
| 28093 | 1526 |
| 28094 | 1542 |
| 28095 | 1533 |
| 28096 | 1536 |
| 28097 | 1564 |
| 28098 | 1571 |
| 28099 | 1587 |
| 28100 | 1627 |
| 28101 | 1677 |
| 28102 | 1729 |
| 28103 | 1771 |
| 28104 | 1814 |
| 28105 | 1882 |
| 28106 | 1956 |
| 28107 | 2020 |
| 28108 | 2031 |
| 28109 | 1991 |
| 28110 | 1962 |
| 28111 | 1936 |
| 28112 | 1889 |
| 28113 | 1810 |
| 28114 | 1756 |
| 28115 | 1702 |
| 28116 | 1656 |
| 28117 | 1612 |
| 28118 | 1617 |
| 28119 | 1577 |
| 28120 | 1466 |
| 28121 | 1378 |
| 28122 | 1300 |
| 28123 | 1215 |
| 28124 | 1129 |
| 28125 | 1066 |
| 28126 | 1015 |
| 28127 | 966 |
| 28128 | 964 |
| 28129 | 950 |
| 28130 | 913 |
| 28131 | 899 |
| 28132 | 882 |
| 28133 | 864 |
| 28134 | 843 |
| 28135 | 826 |
| 28136 | 817 |
| 28137 | 813 |
| 28138 | 793 |
| 28139 | 784 |
| 28140 | 781 |
| 28141 | 776 |
| 28142 | 776 |
| 28143 | 783 |
| 28144 | 795 |
| 28145 | 819 |
| 28146 | 848 |
| 28147 | 888 |
| 28148 | 932 |
| 28149 | 950 |
| 28150 | 991 |
| 28151 | 1046 |
| 28152 | 1165 |
| 28153 | 1236 |
| 28154 | 1288 |
| 28155 | 1373 |
| 28156 | 1475 |
| 28157 | 1526 |
| 28158 | 1574 |
| 28159 | 1558 |
| 28160 | 1598 |
| 28161 | 1612 |
| 28162 | 1620 |
| 28163 | 1628 |
| 28164 | 1598 |
| 28165 | 1576 |
| 28166 | 1532 |
| 28167 | 1461 |
| 28168 | 1405 |
| 28169 | 1362 |
| 28170 | 1307 |
| 28171 | 1279 |
| 28172 | 1260 |
| 28173 | 1281 |
| 28174 | 1360 |
| 28175 | 1324 |
| 28176 | 1340 |
| 28177 | 1353 |
| 28178 | 1282 |
| 28179 | 1255 |
| 28180 | 1264 |
| 28181 | 1274 |
| 28182 | 1280 |
| 28183 | 1247 |
| 28184 | 1177 |
| 28185 | 1197 |
| 28186 | 1202 |
| 28187 | 1176 |
| 28188 | 1204 |
| 28189 | 1168 |
| 28190 | 1183 |
| 28191 | 1240 |
| 28192 | 1339 |
| 28193 | 1424 |
| 28194 | 1486 |
| 28195 | 1544 |
| 28196 | 1603 |
| 28197 | 1668 |
| 28198 | 1731 |
| 28199 | 1799 |
| 28200 | 1828 |
| 28201 | 1888 |
| 28202 | 1978 |
| 28203 | 2079 |
| 28204 | 2097 |
| 28205 | 2070 |
| 28206 | 2037 |
| 28207 | 2001 |
| 28208 | 1948 |
| 28209 | 1888 |
| 28210 | 1820 |
| 28211 | 1759 |
| 28212 | 1711 |
| 28213 | 1657 |
| 28214 | 1627 |
| 28215 | 1594 |
| 28216 | 1509 |
| 28217 | 1433 |
| 28218 | 1368 |
| 28219 | 1286 |
| 28220 | 1202 |
| 28221 | 1133 |
| 28222 | 1070 |
| 28223 | 1019 |
| 28224 | 1021 |
| 28225 | 1008 |
| 28226 | 974 |
| 28227 | 947 |
| 28228 | 920 |
| 28229 | 895 |
| 28230 | 876 |
| 28231 | 855 |
| 28232 | 843 |
| 28233 | 833 |
| 28234 | 829 |
| 28235 | 822 |
| 28236 | 828 |
| 28237 | 820 |
| 28238 | 822 |
| 28239 | 827 |
| 28240 | 847 |
| 28241 | 856 |
| 28242 | 872 |
| 28243 | 896 |
| 28244 | 946 |
| 28245 | 958 |
| 28246 | 1001 |
| 28247 | 1060 |
| 28248 | 1176 |
| 28249 | 1242 |
| 28250 | 1311 |
| 28251 | 1379 |
| 28252 | 1473 |
| 28253 | 1549 |
| 28254 | 1604 |
| 28255 | 1605 |
| 28256 | 1647 |
| 28257 | 1666 |
| 28258 | 1662 |
| 28259 | 1624 |
| 28260 | 1561 |
| 28261 | 1548 |
| 28262 | 1529 |
| 28263 | 1485 |
| 28264 | 1479 |
| 28265 | 1469 |
| 28266 | 1441 |
| 28267 | 1427 |
| 28268 | 1427 |
| 28269 | 1435 |
| 28270 | 1400 |
| 28271 | 1396 |
| 28272 | 1357 |
| 28273 | 1280 |
| 28274 | 1205 |
| 28275 | 1154 |
| 28276 | 1104 |
| 28277 | 1103 |
| 28278 | 1104 |
| 28279 | 1097 |
| 28280 | 1072 |
| 28281 | 1033 |
| 28282 | 1048 |
| 28283 | 1035 |
| 28284 | 1041 |
| 28285 | 1109 |
| 28286 | 1138 |
| 28287 | 1162 |
| 28288 | 1222 |
| 28289 | 1352 |
| 28290 | 1453 |
| 28291 | 1496 |
| 28292 | 1549 |
| 28293 | 1623 |
| 28294 | 1699 |
| 28295 | 1765 |
| 28296 | 1838 |
| 28297 | 1911 |
| 28298 | 2008 |
| 28299 | 2096 |
| 28300 | 2080 |
| 28301 | 2033 |
| 28302 | 1993 |
| 28303 | 1963 |
| 28304 | 1917 |
| 28305 | 1837 |
| 28306 | 1766 |
| 28307 | 1722 |
| 28308 | 1678 |
| 28309 | 1634 |
| 28310 | 1616 |
| 28311 | 1589 |
| 28312 | 1528 |
| 28313 | 1469 |
| 28314 | 1396 |
| 28315 | 1327 |
| 28316 | 1256 |
| 28317 | 1197 |
| 28318 | 1135 |
| 28319 | 1072 |
| 28320 | 1067 |
| 28321 | 1053 |
| 28322 | 1015 |
| 28323 | 983 |
| 28324 | 961 |
| 28325 | 934 |
| 28326 | 907 |
| 28327 | 882 |
| 28328 | 867 |
| 28329 | 848 |
| 28330 | 834 |
| 28331 | 830 |
| 28332 | 830 |
| 28333 | 825 |
| 28334 | 819 |
| 28335 | 815 |
| 28336 | 825 |
| 28337 | 829 |
| 28338 | 831 |
| 28339 | 840 |
| 28340 | 860 |
| 28341 | 858 |
| 28342 | 874 |
| 28343 | 893 |
| 28344 | 965 |
| 28345 | 1001 |
| 28346 | 1048 |
| 28347 | 1087 |
| 28348 | 1146 |
| 28349 | 1197 |
| 28350 | 1246 |
| 28351 | 1292 |
| 28352 | 1328 |
| 28353 | 1368 |
| 28354 | 1399 |
| 28355 | 1421 |
| 28356 | 1450 |
| 28357 | 1449 |
| 28358 | 1480 |
| 28359 | 1508 |
| 28360 | 1529 |
| 28361 | 1538 |
| 28362 | 1531 |
| 28363 | 1513 |
| 28364 | 1489 |
| 28365 | 1434 |
| 28366 | 1368 |
| 28367 | 1317 |
| 28368 | 1252 |
| 28369 | 1222 |
| 28370 | 1185 |
| 28371 | 1159 |
| 28372 | 1150 |
| 28373 | 1169 |
| 28374 | 1194 |
| 28375 | 1213 |
| 28376 | 1207 |
| 28377 | 1207 |
| 28378 | 1223 |
| 28379 | 1224 |
| 28380 | 1232 |
| 28381 | 1237 |
| 28382 | 1254 |
| 28383 | 1265 |
| 28384 | 1293 |
| 28385 | 1322 |
| 28386 | 1371 |
| 28387 | 1433 |
| 28388 | 1500 |
| 28389 | 1577 |
| 28390 | 1668 |
| 28391 | 1733 |
| 28392 | 1784 |
| 28393 | 1853 |
| 28394 | 1938 |
| 28395 | 1991 |
| 28396 | 1975 |
| 28397 | 1936 |
| 28398 | 1880 |
| 28399 | 1847 |
| 28400 | 1798 |
| 28401 | 1723 |
| 28402 | 1663 |
| 28403 | 1619 |
| 28404 | 1585 |
| 28405 | 1531 |
| 28406 | 1515 |
| 28407 | 1499 |
| 28408 | 1442 |
| 28409 | 1398 |
| 28410 | 1340 |
| 28411 | 1289 |
| 28412 | 1226 |
| 28413 | 1170 |
| 28414 | 1114 |
| 28415 | 1065 |
| 28416 | 980 |
| 28417 | 959 |
| 28418 | 923 |
| 28419 | 889 |
| 28420 | 861 |
| 28421 | 838 |
| 28422 | 818 |
| 28423 | 799 |
| 28424 | 788 |
| 28425 | 772 |
| 28426 | 759 |
| 28427 | 751 |
| 28428 | 747 |
| 28429 | 745 |
| 28430 | 744 |
| 28431 | 743 |
| 28432 | 748 |
| 28433 | 746 |
| 28434 | 755 |
| 28435 | 757 |
| 28436 | 769 |
| 28437 | 770 |
| 28438 | 772 |
| 28439 | 773 |
| 28440 | 808 |
| 28441 | 819 |
| 28442 | 845 |
| 28443 | 867 |
| 28444 | 917 |
| 28445 | 948 |
| 28446 | 957 |
| 28447 | 995 |
| 28448 | 1045 |
| 28449 | 1097 |
| 28450 | 1123 |
| 28451 | 1133 |
| 28452 | 1143 |
| 28453 | 1136 |
| 28454 | 1160 |
| 28455 | 1153 |
| 28456 | 1124 |
| 28457 | 1105 |
| 28458 | 1094 |
| 28459 | 1102 |
| 28460 | 1137 |
| 28461 | 1118 |
| 28462 | 1110 |
| 28463 | 1052 |
| 28464 | 957 |
| 28465 | 867 |
| 28466 | 821 |
| 28467 | 757 |
| 28468 | 734 |
| 28469 | 670 |
| 28470 | 673 |
| 28471 | 664 |
| 28472 | 577 |
| 28473 | 498 |
| 28474 | 518 |
| 28475 | 488 |
| 28476 | 496 |
| 28477 | 530 |
| 28478 | 581 |
| 28479 | 656 |
| 28480 | 724 |
| 28481 | 821 |
| 28482 | 903 |
| 28483 | 982 |
| 28484 | 1079 |
| 28485 | 1188 |
| 28486 | 1283 |
| 28487 | 1373 |
| 28488 | 1462 |
| 28489 | 1531 |
| 28490 | 1628 |
| 28491 | 1758 |
| 28492 | 1772 |
| 28493 | 1760 |
| 28494 | 1735 |
| 28495 | 1703 |
| 28496 | 1668 |
| 28497 | 1616 |
| 28498 | 1538 |
| 28499 | 1475 |
| 28500 | 1424 |
| 28501 | 1385 |
| 28502 | 1362 |
| 28503 | 1317 |
| 28504 | 1245 |
| 28505 | 1179 |
| 28506 | 1101 |
| 28507 | 1031 |
| 28508 | 961 |
| 28509 | 897 |
| 28510 | 850 |
| 28511 | 808 |
| 28512 | 800 |
| 28513 | 778 |
| 28514 | 742 |
| 28515 | 720 |
| 28516 | 703 |
| 28517 | 692 |
| 28518 | 692 |
| 28519 | 690 |
| 28520 | 691 |
| 28521 | 681 |
| 28522 | 660 |
| 28523 | 653 |
| 28524 | 660 |
| 28525 | 665 |
| 28526 | 666 |
| 28527 | 668 |
| 28528 | 693 |
| 28529 | 702 |
| 28530 | 728 |
| 28531 | 746 |
| 28532 | 799 |
| 28533 | 825 |
| 28534 | 890 |
| 28535 | 948 |
| 28536 | 1060 |
| 28537 | 1148 |
| 28538 | 1209 |
| 28539 | 1276 |
| 28540 | 1385 |
| 28541 | 1440 |
| 28542 | 1486 |
| 28543 | 1488 |
| 28544 | 1540 |
| 28545 | 1564 |
| 28546 | 1589 |
| 28547 | 1607 |
| 28548 | 1609 |
| 28549 | 1601 |
| 28550 | 1634 |
| 28551 | 1624 |
| 28552 | 1631 |
| 28553 | 1611 |
| 28554 | 1645 |
| 28555 | 1664 |
| 28556 | 1696 |
| 28557 | 1722 |
| 28558 | 1682 |
| 28559 | 1668 |
| 28560 | 1577 |
| 28561 | 1446 |
| 28562 | 1363 |
| 28563 | 1341 |
| 28564 | 1290 |
| 28565 | 1149 |
| 28566 | 1152 |
| 28567 | 1250 |
| 28568 | 1317 |
| 28569 | 1321 |
| 28570 | 1373 |
| 28571 | 1377 |
| 28572 | 1399 |
| 28573 | 1394 |
| 28574 | 1433 |
| 28575 | 1423 |
| 28576 | 1459 |
| 28577 | 1452 |
| 28578 | 1444 |
| 28579 | 1508 |
| 28580 | 1553 |
| 28581 | 1579 |
| 28582 | 1655 |
| 28583 | 1728 |
| 28584 | 1779 |
| 28585 | 1834 |
| 28586 | 1927 |
| 28587 | 2011 |
| 28588 | 2043 |
| 28589 | 2028 |
| 28590 | 1991 |
| 28591 | 1952 |
| 28592 | 1903 |
| 28593 | 1822 |
| 28594 | 1759 |
| 28595 | 1704 |
| 28596 | 1658 |
| 28597 | 1597 |
| 28598 | 1562 |
| 28599 | 1514 |
| 28600 | 1438 |
| 28601 | 1359 |
| 28602 | 1281 |
| 28603 | 1201 |
| 28604 | 1117 |
| 28605 | 1052 |
| 28606 | 995 |
| 28607 | 953 |
| 28608 | 955 |
| 28609 | 938 |
| 28610 | 905 |
| 28611 | 881 |
| 28612 | 860 |
| 28613 | 839 |
| 28614 | 819 |
| 28615 | 805 |
| 28616 | 795 |
| 28617 | 781 |
| 28618 | 780 |
| 28619 | 772 |
| 28620 | 763 |
| 28621 | 758 |
| 28622 | 760 |
| 28623 | 771 |
| 28624 | 793 |
| 28625 | 812 |
| 28626 | 835 |
| 28627 | 869 |
| 28628 | 909 |
| 28629 | 935 |
| 28630 | 981 |
| 28631 | 1041 |
| 28632 | 1150 |
| 28633 | 1210 |
| 28634 | 1281 |
| 28635 | 1350 |
| 28636 | 1440 |
| 28637 | 1520 |
| 28638 | 1544 |
| 28639 | 1546 |
| 28640 | 1578 |
| 28641 | 1594 |
| 28642 | 1602 |
| 28643 | 1569 |
| 28644 | 1507 |
| 28645 | 1456 |
| 28646 | 1462 |
| 28647 | 1487 |
| 28648 | 1449 |
| 28649 | 1452 |
| 28650 | 1453 |
| 28651 | 1416 |
| 28652 | 1439 |
| 28653 | 1553 |
| 28654 | 1597 |
| 28655 | 1530 |
| 28656 | 1473 |
| 28657 | 1460 |
| 28658 | 1394 |
| 28659 | 1393 |
| 28660 | 1410 |
| 28661 | 1368 |
| 28662 | 1413 |
| 28663 | 1350 |
| 28664 | 1279 |
| 28665 | 1271 |
| 28666 | 1279 |
| 28667 | 1363 |
| 28668 | 1414 |
| 28669 | 1414 |
| 28670 | 1393 |
| 28671 | 1387 |
| 28672 | 1416 |
| 28673 | 1427 |
| 28674 | 1458 |
| 28675 | 1460 |
| 28676 | 1533 |
| 28677 | 1645 |
| 28678 | 1708 |
| 28679 | 1757 |
| 28680 | 1785 |
| 28681 | 1853 |
| 28682 | 1943 |
| 28683 | 2011 |
| 28684 | 2067 |
| 28685 | 1991 |
| 28686 | 1952 |
| 28687 | 1911 |
| 28688 | 1850 |
| 28689 | 1771 |
| 28690 | 1713 |
| 28691 | 1653 |
| 28692 | 1603 |
| 28693 | 1545 |
| 28694 | 1531 |
| 28695 | 1481 |
| 28696 | 1393 |
| 28697 | 1323 |
| 28698 | 1249 |
| 28699 | 1174 |
| 28700 | 1091 |
| 28701 | 1023 |
| 28702 | 961 |
| 28703 | 910 |
| 28704 | 900 |
| 28705 | 887 |
| 28706 | 863 |
| 28707 | 852 |
| 28708 | 815 |
| 28709 | 788 |
| 28710 | 767 |
| 28711 | 758 |
| 28712 | 744 |
| 28713 | 742 |
| 28714 | 758 |
| 28715 | 756 |
| 28716 | 764 |
| 28717 | 757 |
| 28718 | 741 |
| 28719 | 741 |
| 28720 | 756 |
| 28721 | 770 |
| 28722 | 787 |
| 28723 | 797 |
| 28724 | 852 |
| 28725 | 885 |
| 28726 | 928 |
| 28727 | 994 |
| 28728 | 1107 |
| 28729 | 1172 |
| 28730 | 1237 |
| 28731 | 1312 |
| 28732 | 1422 |
| 28733 | 1490 |
| 28734 | 1526 |
| 28735 | 1546 |
| 28736 | 1573 |
| 28737 | 1603 |
| 28738 | 1617 |
| 28739 | 1584 |
| 28740 | 1538 |
| 28741 | 1593 |
| 28742 | 1621 |
| 28743 | 1561 |
| 28744 | 1575 |
| 28745 | 1584 |
| 28746 | 1511 |
| 28747 | 1445 |
| 28748 | 1503 |
| 28749 | 1552 |
| 28750 | 1596 |
| 28751 | 1526 |
| 28752 | 1554 |
| 28753 | 1547 |
| 28754 | 1481 |
| 28755 | 1401 |
| 28756 | 1386 |
| 28757 | 1426 |
| 28758 | 1443 |
| 28759 | 1440 |
| 28760 | 1447 |
| 28761 | 1482 |
| 28762 | 1532 |
| 28763 | 1522 |
| 28764 | 1515 |
| 28765 | 1526 |
| 28766 | 1542 |
| 28767 | 1533 |
| 28768 | 1536 |
| 28769 | 1564 |
| 28770 | 1571 |
| 28771 | 1587 |
| 28772 | 1627 |
| 28773 | 1677 |
| 28774 | 1729 |
| 28775 | 1771 |
| 28776 | 1814 |
| 28777 | 1882 |
| 28778 | 1956 |
| 28779 | 2020 |
| 28780 | 2031 |
| 28781 | 1991 |
| 28782 | 1962 |
| 28783 | 1936 |
| 28784 | 1889 |
| 28785 | 1810 |
| 28786 | 1756 |
| 28787 | 1702 |
| 28788 | 1656 |
| 28789 | 1612 |
| 28790 | 1617 |
| 28791 | 1577 |
| 28792 | 1466 |
| 28793 | 1378 |
| 28794 | 1300 |
| 28795 | 1215 |
| 28796 | 1129 |
| 28797 | 1066 |
| 28798 | 1015 |
| 28799 | 966 |
| 28800 | 964 |
| 28801 | 950 |
| 28802 | 913 |
| 28803 | 899 |
| 28804 | 882 |
| 28805 | 864 |
| 28806 | 843 |
| 28807 | 826 |
| 28808 | 817 |
| 28809 | 813 |
| 28810 | 793 |
| 28811 | 784 |
| 28812 | 781 |
| 28813 | 776 |
| 28814 | 776 |
| 28815 | 783 |
| 28816 | 795 |
| 28817 | 819 |
| 28818 | 848 |
| 28819 | 888 |
| 28820 | 932 |
| 28821 | 950 |
| 28822 | 991 |
| 28823 | 1046 |
| 28824 | 1165 |
| 28825 | 1236 |
| 28826 | 1288 |
| 28827 | 1373 |
| 28828 | 1475 |
| 28829 | 1526 |
| 28830 | 1574 |
| 28831 | 1558 |
| 28832 | 1598 |
| 28833 | 1612 |
| 28834 | 1620 |
| 28835 | 1628 |
| 28836 | 1598 |
| 28837 | 1576 |
| 28838 | 1532 |
| 28839 | 1461 |
| 28840 | 1405 |
| 28841 | 1362 |
| 28842 | 1307 |
| 28843 | 1279 |
| 28844 | 1260 |
| 28845 | 1281 |
| 28846 | 1360 |
| 28847 | 1324 |
| 28848 | 1340 |
| 28849 | 1353 |
| 28850 | 1282 |
| 28851 | 1255 |
| 28852 | 1264 |
| 28853 | 1274 |
| 28854 | 1280 |
| 28855 | 1247 |
| 28856 | 1177 |
| 28857 | 1197 |
| 28858 | 1202 |
| 28859 | 1176 |
| 28860 | 1204 |
| 28861 | 1168 |
| 28862 | 1183 |
| 28863 | 1240 |
| 28864 | 1339 |
| 28865 | 1424 |
| 28866 | 1486 |
| 28867 | 1544 |
| 28868 | 1603 |
| 28869 | 1668 |
| 28870 | 1731 |
| 28871 | 1799 |
| 28872 | 1828 |
| 28873 | 1888 |
| 28874 | 1978 |
| 28875 | 2079 |
| 28876 | 2097 |
| 28877 | 2070 |
| 28878 | 2037 |
| 28879 | 2001 |
| 28880 | 1948 |
| 28881 | 1888 |
| 28882 | 1820 |
| 28883 | 1759 |
| 28884 | 1711 |
| 28885 | 1657 |
| 28886 | 1627 |
| 28887 | 1594 |
| 28888 | 1509 |
| 28889 | 1433 |
| 28890 | 1368 |
| 28891 | 1286 |
| 28892 | 1202 |
| 28893 | 1133 |
| 28894 | 1070 |
| 28895 | 1019 |
| 28896 | 1021 |
| 28897 | 1008 |
| 28898 | 974 |
| 28899 | 947 |
| 28900 | 920 |
| 28901 | 895 |
| 28902 | 876 |
| 28903 | 855 |
| 28904 | 843 |
| 28905 | 833 |
| 28906 | 829 |
| 28907 | 822 |
| 28908 | 828 |
| 28909 | 820 |
| 28910 | 822 |
| 28911 | 827 |
| 28912 | 847 |
| 28913 | 856 |
| 28914 | 872 |
| 28915 | 896 |
| 28916 | 946 |
| 28917 | 958 |
| 28918 | 1001 |
| 28919 | 1060 |
| 28920 | 1176 |
| 28921 | 1242 |
| 28922 | 1311 |
| 28923 | 1379 |
| 28924 | 1473 |
| 28925 | 1549 |
| 28926 | 1604 |
| 28927 | 1605 |
| 28928 | 1647 |
| 28929 | 1666 |
| 28930 | 1662 |
| 28931 | 1624 |
| 28932 | 1561 |
| 28933 | 1548 |
| 28934 | 1529 |
| 28935 | 1485 |
| 28936 | 1479 |
| 28937 | 1469 |
| 28938 | 1441 |
| 28939 | 1427 |
| 28940 | 1427 |
| 28941 | 1435 |
| 28942 | 1400 |
| 28943 | 1396 |
| 28944 | 1357 |
| 28945 | 1280 |
| 28946 | 1205 |
| 28947 | 1154 |
| 28948 | 1104 |
| 28949 | 1103 |
| 28950 | 1104 |
| 28951 | 1097 |
| 28952 | 1072 |
| 28953 | 1033 |
| 28954 | 1048 |
| 28955 | 1035 |
| 28956 | 1041 |
| 28957 | 1109 |
| 28958 | 1138 |
| 28959 | 1162 |
| 28960 | 1222 |
| 28961 | 1352 |
| 28962 | 1453 |
| 28963 | 1496 |
| 28964 | 1549 |
| 28965 | 1623 |
| 28966 | 1699 |
| 28967 | 1765 |
| 28968 | 1838 |
| 28969 | 1911 |
| 28970 | 2008 |
| 28971 | 2096 |
| 28972 | 2080 |
| 28973 | 2033 |
| 28974 | 1993 |
| 28975 | 1963 |
| 28976 | 1917 |
| 28977 | 1837 |
| 28978 | 1766 |
| 28979 | 1722 |
| 28980 | 1678 |
| 28981 | 1634 |
| 28982 | 1616 |
| 28983 | 1589 |
| 28984 | 1528 |
| 28985 | 1469 |
| 28986 | 1396 |
| 28987 | 1327 |
| 28988 | 1256 |
| 28989 | 1197 |
| 28990 | 1135 |
| 28991 | 1072 |
| 28992 | 1067 |
| 28993 | 1053 |
| 28994 | 1015 |
| 28995 | 983 |
| 28996 | 961 |
| 28997 | 934 |
| 28998 | 907 |
| 28999 | 882 |
| 29000 | 867 |
| 29001 | 848 |
| 29002 | 834 |
| 29003 | 830 |
| 29004 | 830 |
| 29005 | 825 |
| 29006 | 819 |
| 29007 | 815 |
| 29008 | 825 |
| 29009 | 829 |
| 29010 | 831 |
| 29011 | 840 |
| 29012 | 860 |
| 29013 | 858 |
| 29014 | 874 |
| 29015 | 893 |
| 29016 | 965 |
| 29017 | 1001 |
| 29018 | 1048 |
| 29019 | 1087 |
| 29020 | 1146 |
| 29021 | 1197 |
| 29022 | 1246 |
| 29023 | 1292 |
| 29024 | 1328 |
| 29025 | 1368 |
| 29026 | 1399 |
| 29027 | 1421 |
| 29028 | 1450 |
| 29029 | 1449 |
| 29030 | 1480 |
| 29031 | 1508 |
| 29032 | 1529 |
| 29033 | 1538 |
| 29034 | 1531 |
| 29035 | 1513 |
| 29036 | 1489 |
| 29037 | 1434 |
| 29038 | 1368 |
| 29039 | 1317 |
| 29040 | 1252 |
| 29041 | 1222 |
| 29042 | 1185 |
| 29043 | 1159 |
| 29044 | 1150 |
| 29045 | 1169 |
| 29046 | 1194 |
| 29047 | 1213 |
| 29048 | 1207 |
| 29049 | 1207 |
| 29050 | 1223 |
| 29051 | 1224 |
| 29052 | 1232 |
| 29053 | 1237 |
| 29054 | 1254 |
| 29055 | 1265 |
| 29056 | 1293 |
| 29057 | 1322 |
| 29058 | 1371 |
| 29059 | 1433 |
| 29060 | 1500 |
| 29061 | 1577 |
| 29062 | 1668 |
| 29063 | 1733 |
| 29064 | 1784 |
| 29065 | 1853 |
| 29066 | 1938 |
| 29067 | 1991 |
| 29068 | 1975 |
| 29069 | 1936 |
| 29070 | 1880 |
| 29071 | 1847 |
| 29072 | 1798 |
| 29073 | 1723 |
| 29074 | 1663 |
| 29075 | 1619 |
| 29076 | 1585 |
| 29077 | 1531 |
| 29078 | 1515 |
| 29079 | 1499 |
| 29080 | 1442 |
| 29081 | 1398 |
| 29082 | 1340 |
| 29083 | 1289 |
| 29084 | 1226 |
| 29085 | 1170 |
| 29086 | 1114 |
| 29087 | 1065 |
| 29088 | 1116 |
| 29089 | 1101 |
| 29090 | 1061 |
| 29091 | 1023 |
| 29092 | 994 |
| 29093 | 964 |
| 29094 | 934 |
| 29095 | 904 |
| 29096 | 874 |
| 29097 | 854 |
| 29098 | 842 |
| 29099 | 831 |
| 29100 | 874 |
| 29101 | 854 |
| 29102 | 842 |
| 29103 | 831 |
| 29104 | 823 |
| 29105 | 811 |
| 29106 | 815 |
| 29107 | 816 |
| 29108 | 834 |
| 29109 | 823 |
| 29110 | 830 |
| 29111 | 837 |
| 29112 | 854 |
| 29113 | 848 |
| 29114 | 855 |
| 29115 | 843 |
| 29116 | 874 |
| 29117 | 890 |
| 29118 | 922 |
| 29119 | 952 |
| 29120 | 972 |
| 29121 | 1008 |
| 29122 | 1065 |
| 29123 | 1104 |
| 29124 | 1142 |
| 29125 | 1176 |
| 29126 | 1200 |
| 29127 | 1230 |
| 29128 | 1256 |
| 29129 | 1289 |
| 29130 | 1290 |
| 29131 | 1304 |
| 29132 | 1328 |
| 29133 | 1300 |
| 29134 | 1269 |
| 29135 | 1294 |
| 29136 | 1305 |
| 29137 | 1351 |
| 29138 | 1387 |
| 29139 | 1391 |
| 29140 | 1354 |
| 29141 | 1343 |
| 29142 | 1371 |
| 29143 | 1381 |
| 29144 | 1375 |
| 29145 | 1388 |
| 29146 | 1396 |
| 29147 | 1363 |
| 29148 | 1318 |
| 29149 | 1293 |
| 29150 | 1265 |
| 29151 | 1293 |
| 29152 | 1285 |
| 29153 | 1281 |
| 29154 | 1327 |
| 29155 | 1356 |
| 29156 | 1382 |
| 29157 | 1418 |
| 29158 | 1481 |
| 29159 | 1562 |
| 29160 | 1689 |
| 29161 | 1818 |
| 29162 | 1915 |
| 29163 | 1969 |
| 29164 | 1992 |
| 29165 | 1980 |
| 29166 | 1969 |
| 29167 | 1929 |
| 29168 | 1896 |
| 29169 | 1841 |
| 29170 | 1815 |
| 29171 | 1795 |
| 29172 | 1762 |
| 29173 | 1695 |
| 29174 | 1629 |
| 29175 | 1576 |
| 29176 | 1550 |
| 29177 | 1517 |
| 29178 | 1512 |
| 29179 | 1499 |
| 29180 | 1429 |
| 29181 | 1361 |
| 29182 | 1291 |
| 29183 | 1224 |
| 29184 | 1150 |
| 29185 | 1078 |
| 29186 | 1020 |
| 29187 | 969 |
| 29188 | 978 |
| 29189 | 980 |
| 29190 | 946 |
| 29191 | 919 |
| 29192 | 888 |
| 29193 | 864 |
| 29194 | 843 |
| 29195 | 822 |
| 29196 | 800 |
| 29197 | 776 |
| 29198 | 762 |
| 29199 | 756 |
| 29200 | 768 |
| 29201 | 765 |
| 29202 | 769 |
| 29203 | 778 |
| 29204 | 810 |
| 29205 | 826 |
| 29206 | 849 |
| 29207 | 871 |
| 29208 | 927 |
| 29209 | 955 |
| 29210 | 1004 |
| 29211 | 1064 |
| 29212 | 1209 |
| 29213 | 1282 |
| 29214 | 1369 |
| 29215 | 1440 |
| 29216 | 1501 |
| 29217 | 1530 |
| 29218 | 1553 |
| 29219 | 1586 |
| 29220 | 1619 |
| 29221 | 1631 |
| 29222 | 1635 |
| 29223 | 1619 |
| 29224 | 1596 |
| 29225 | 1604 |
| 29226 | 1626 |
| 29227 | 1641 |
| 29228 | 1650 |
| 29229 | 1662 |
| 29230 | 1673 |
| 29231 | 1664 |
| 29232 | 1692 |
| 29233 | 1751 |
| 29234 | 1807 |
| 29235 | 1822 |
| 29236 | 1815 |
| 29237 | 1801 |
| 29238 | 1767 |
| 29239 | 1746 |
| 29240 | 1718 |
| 29241 | 1717 |
| 29242 | 1729 |
| 29243 | 1700 |
| 29244 | 1687 |
| 29245 | 1677 |
| 29246 | 1660 |
| 29247 | 1654 |
| 29248 | 1691 |
| 29249 | 1713 |
| 29250 | 1738 |
| 29251 | 1763 |
| 29252 | 1799 |
| 29253 | 1831 |
| 29254 | 1861 |
| 29255 | 1920 |
| 29256 | 2028 |
| 29257 | 2101 |
| 29258 | 2175 |
| 29259 | 2206 |
| 29260 | 2210 |
| 29261 | 2195 |
| 29262 | 2191 |
| 29263 | 2178 |
| 29264 | 2142 |
| 29265 | 2093 |
| 29266 | 2050 |
| 29267 | 2017 |
| 29268 | 1972 |
| 29269 | 1892 |
| 29270 | 1819 |
| 29271 | 1761 |
| 29272 | 1721 |
| 29273 | 1661 |
| 29274 | 1650 |
| 29275 | 1627 |
| 29276 | 1544 |
| 29277 | 1462 |
| 29278 | 1383 |
| 29279 | 1297 |
| 29280 | 1208 |
| 29281 | 1135 |
| 29282 | 1068 |
| 29283 | 1021 |
| 29284 | 1038 |
| 29285 | 1045 |
| 29286 | 1011 |
| 29287 | 985 |
| 29288 | 961 |
| 29289 | 931 |
| 29290 | 905 |
| 29291 | 886 |
| 29292 | 874 |
| 29293 | 858 |
| 29294 | 850 |
| 29295 | 848 |
| 29296 | 847 |
| 29297 | 845 |
| 29298 | 856 |
| 29299 | 867 |
| 29300 | 897 |
| 29301 | 898 |
| 29302 | 920 |
| 29303 | 948 |
| 29304 | 998 |
| 29305 | 1012 |
| 29306 | 1063 |
| 29307 | 1117 |
| 29308 | 1241 |
| 29309 | 1323 |
| 29310 | 1394 |
| 29311 | 1465 |
| 29312 | 1537 |
| 29313 | 1549 |
| 29314 | 1582 |
| 29315 | 1616 |
| 29316 | 1650 |
| 29317 | 1654 |
| 29318 | 1659 |
| 29319 | 1662 |
| 29320 | 1663 |
| 29321 | 1677 |
| 29322 | 1676 |
| 29323 | 1680 |
| 29324 | 1696 |
| 29325 | 1712 |
| 29326 | 1729 |
| 29327 | 1736 |
| 29328 | 1742 |
| 29329 | 1764 |
| 29330 | 1807 |
| 29331 | 1818 |
| 29332 | 1788 |
| 29333 | 1756 |
| 29334 | 1684 |
| 29335 | 1671 |
| 29336 | 1685 |
| 29337 | 1705 |
| 29338 | 1674 |
| 29339 | 1595 |
| 29340 | 1647 |
| 29341 | 1659 |
| 29342 | 1663 |
| 29343 | 1649 |
| 29344 | 1644 |
| 29345 | 1671 |
| 29346 | 1690 |
| 29347 | 1714 |
| 29348 | 1735 |
| 29349 | 1776 |
| 29350 | 1823 |
| 29351 | 1889 |
| 29352 | 1991 |
| 29353 | 2100 |
| 29354 | 2168 |
| 29355 | 2206 |
| 29356 | 2209 |
| 29357 | 2191 |
| 29358 | 2173 |
| 29359 | 2167 |
| 29360 | 2134 |
| 29361 | 2085 |
| 29362 | 2056 |
| 29363 | 2020 |
| 29364 | 1977 |
| 29365 | 1905 |
| 29366 | 1845 |
| 29367 | 1786 |
| 29368 | 1748 |
| 29369 | 1704 |
| 29370 | 1698 |
| 29371 | 1665 |
| 29372 | 1569 |
| 29373 | 1488 |
| 29374 | 1401 |
| 29375 | 1320 |
| 29376 | 1242 |
| 29377 | 1169 |
| 29378 | 1106 |
| 29379 | 1056 |
| 29380 | 1076 |
| 29381 | 1074 |
| 29382 | 1043 |
| 29383 | 1019 |
| 29384 | 991 |
| 29385 | 967 |
| 29386 | 941 |
| 29387 | 914 |
| 29388 | 899 |
| 29389 | 885 |
| 29390 | 877 |
| 29391 | 874 |
| 29392 | 874 |
| 29393 | 877 |
| 29394 | 885 |
| 29395 | 891 |
| 29396 | 920 |
| 29397 | 925 |
| 29398 | 947 |
| 29399 | 974 |
| 29400 | 1021 |
| 29401 | 1039 |
| 29402 | 1085 |
| 29403 | 1142 |
| 29404 | 1263 |
| 29405 | 1344 |
| 29406 | 1415 |
| 29407 | 1496 |
| 29408 | 1571 |
| 29409 | 1603 |
| 29410 | 1619 |
| 29411 | 1655 |
| 29412 | 1696 |
| 29413 | 1720 |
| 29414 | 1726 |
| 29415 | 1742 |
| 29416 | 1727 |
| 29417 | 1744 |
| 29418 | 1752 |
| 29419 | 1743 |
| 29420 | 1738 |
| 29421 | 1714 |
| 29422 | 1723 |
| 29423 | 1695 |
| 29424 | 1714 |
| 29425 | 1763 |
| 29426 | 1791 |
| 29427 | 1801 |
| 29428 | 1794 |
| 29429 | 1777 |
| 29430 | 1739 |
| 29431 | 1734 |
| 29432 | 1735 |
| 29433 | 1740 |
| 29434 | 1759 |
| 29435 | 1752 |
| 29436 | 1735 |
| 29437 | 1720 |
| 29438 | 1693 |
| 29439 | 1683 |
| 29440 | 1713 |
| 29441 | 1723 |
| 29442 | 1725 |
| 29443 | 1744 |
| 29444 | 1780 |
| 29445 | 1824 |
| 29446 | 1880 |
| 29447 | 1945 |
| 29448 | 2065 |
| 29449 | 2162 |
| 29450 | 2230 |
| 29451 | 2275 |
| 29452 | 2277 |
| 29453 | 2262 |
| 29454 | 2240 |
| 29455 | 2229 |
| 29456 | 2188 |
| 29457 | 2138 |
| 29458 | 2091 |
| 29459 | 2047 |
| 29460 | 2006 |
| 29461 | 1934 |
| 29462 | 1863 |
| 29463 | 1802 |
| 29464 | 1762 |
| 29465 | 1725 |
| 29466 | 1725 |
| 29467 | 1677 |
| 29468 | 1583 |
| 29469 | 1506 |
| 29470 | 1429 |
| 29471 | 1353 |
| 29472 | 1266 |
| 29473 | 1194 |
| 29474 | 1132 |
| 29475 | 1077 |
| 29476 | 1083 |
| 29477 | 1084 |
| 29478 | 1051 |
| 29479 | 1017 |
| 29480 | 985 |
| 29481 | 961 |
| 29482 | 940 |
| 29483 | 918 |
| 29484 | 902 |
| 29485 | 887 |
| 29486 | 882 |
| 29487 | 877 |
| 29488 | 877 |
| 29489 | 876 |
| 29490 | 877 |
| 29491 | 884 |
| 29492 | 912 |
| 29493 | 918 |
| 29494 | 938 |
| 29495 | 961 |
| 29496 | 1009 |
| 29497 | 1036 |
| 29498 | 1081 |
| 29499 | 1135 |
| 29500 | 1261 |
| 29501 | 1342 |
| 29502 | 1417 |
| 29503 | 1493 |
| 29504 | 1568 |
| 29505 | 1590 |
| 29506 | 1617 |
| 29507 | 1664 |
| 29508 | 1700 |
| 29509 | 1704 |
| 29510 | 1708 |
| 29511 | 1715 |
| 29512 | 1710 |
| 29513 | 1710 |
| 29514 | 1698 |
| 29515 | 1691 |
| 29516 | 1668 |
| 29517 | 1670 |
| 29518 | 1649 |
| 29519 | 1653 |
| 29520 | 1691 |
| 29521 | 1718 |
| 29522 | 1752 |
| 29523 | 1792 |
| 29524 | 1757 |
| 29525 | 1693 |
| 29526 | 1614 |
| 29527 | 1598 |
| 29528 | 1623 |
| 29529 | 1620 |
| 29530 | 1625 |
| 29531 | 1617 |
| 29532 | 1617 |
| 29533 | 1593 |
| 29534 | 1585 |
| 29535 | 1596 |
| 29536 | 1622 |
| 29537 | 1642 |
| 29538 | 1670 |
| 29539 | 1701 |
| 29540 | 1747 |
| 29541 | 1791 |
| 29542 | 1841 |
| 29543 | 1914 |
| 29544 | 2020 |
| 29545 | 2159 |
| 29546 | 2222 |
| 29547 | 2267 |
| 29548 | 2258 |
| 29549 | 2240 |
| 29550 | 2223 |
| 29551 | 2213 |
| 29552 | 2174 |
| 29553 | 2129 |
| 29554 | 2097 |
| 29555 | 2050 |
| 29556 | 1998 |
| 29557 | 1927 |
| 29558 | 1865 |
| 29559 | 1805 |
| 29560 | 1765 |
| 29561 | 1717 |
| 29562 | 1706 |
| 29563 | 1680 |
| 29564 | 1592 |
| 29565 | 1522 |
| 29566 | 1448 |
| 29567 | 1375 |
| 29568 | 1286 |
| 29569 | 1209 |
| 29570 | 1145 |
| 29571 | 1086 |
| 29572 | 1101 |
| 29573 | 1101 |
| 29574 | 1065 |
| 29575 | 1033 |
| 29576 | 1001 |
| 29577 | 974 |
| 29578 | 947 |
| 29579 | 929 |
| 29580 | 906 |
| 29581 | 890 |
| 29582 | 883 |
| 29583 | 881 |
| 29584 | 880 |
| 29585 | 880 |
| 29586 | 888 |
| 29587 | 894 |
| 29588 | 915 |
| 29589 | 921 |
| 29590 | 944 |
| 29591 | 964 |
| 29592 | 1013 |
| 29593 | 1028 |
| 29594 | 1069 |
| 29595 | 1120 |
| 29596 | 1243 |
| 29597 | 1313 |
| 29598 | 1390 |
| 29599 | 1459 |
| 29600 | 1527 |
| 29601 | 1566 |
| 29602 | 1588 |
| 29603 | 1627 |
| 29604 | 1666 |
| 29605 | 1672 |
| 29606 | 1660 |
| 29607 | 1639 |
| 29608 | 1602 |
| 29609 | 1598 |
| 29610 | 1607 |
| 29611 | 1624 |
| 29612 | 1621 |
| 29613 | 1594 |
| 29614 | 1592 |
| 29615 | 1629 |
| 29616 | 1679 |
| 29617 | 1736 |
| 29618 | 1782 |
| 29619 | 1807 |
| 29620 | 1789 |
| 29621 | 1743 |
| 29622 | 1684 |
| 29623 | 1633 |
| 29624 | 1594 |
| 29625 | 1594 |
| 29626 | 1616 |
| 29627 | 1604 |
| 29628 | 1612 |
| 29629 | 1636 |
| 29630 | 1648 |
| 29631 | 1649 |
| 29632 | 1661 |
| 29633 | 1681 |
| 29634 | 1696 |
| 29635 | 1710 |
| 29636 | 1742 |
| 29637 | 1785 |
| 29638 | 1838 |
| 29639 | 1920 |
| 29640 | 2058 |
| 29641 | 2153 |
| 29642 | 2219 |
| 29643 | 2250 |
| 29644 | 2235 |
| 29645 | 2200 |
| 29646 | 2181 |
| 29647 | 2165 |
| 29648 | 2133 |
| 29649 | 2081 |
| 29650 | 2023 |
| 29651 | 1977 |
| 29652 | 1937 |
| 29653 | 1874 |
| 29654 | 1818 |
| 29655 | 1764 |
| 29656 | 1735 |
| 29657 | 1697 |
| 29658 | 1695 |
| 29659 | 1662 |
| 29660 | 1578 |
| 29661 | 1528 |
| 29662 | 1458 |
| 29663 | 1397 |
| 29664 | 1320 |
| 29665 | 1253 |
| 29666 | 1184 |
| 29667 | 1128 |
| 29668 | 1141 |
| 29669 | 1137 |
| 29670 | 1097 |
| 29671 | 1066 |
| 29672 | 1037 |
| 29673 | 1008 |
| 29674 | 973 |
| 29675 | 945 |
| 29676 | 923 |
| 29677 | 905 |
| 29678 | 889 |
| 29679 | 882 |
| 29680 | 880 |
| 29681 | 872 |
| 29682 | 872 |
| 29683 | 877 |
| 29684 | 889 |
| 29685 | 872 |
| 29686 | 878 |
| 29687 | 890 |
| 29688 | 913 |
| 29689 | 902 |
| 29690 | 903 |
| 29691 | 904 |
| 29692 | 975 |
| 29693 | 1019 |
| 29694 | 1069 |
| 29695 | 1124 |
| 29696 | 1181 |
| 29697 | 1226 |
| 29698 | 1260 |
| 29699 | 1317 |
| 29700 | 1365 |
| 29701 | 1410 |
| 29702 | 1449 |
| 29703 | 1464 |
| 29704 | 1470 |
| 29705 | 1475 |
| 29706 | 1499 |
| 29707 | 1496 |
| 29708 | 1501 |
| 29709 | 1498 |
| 29710 | 1482 |
| 29711 | 1448 |
| 29712 | 1388 |
| 29713 | 1413 |
| 29714 | 1461 |
| 29715 | 1507 |
| 29716 | 1477 |
| 29717 | 1480 |
| 29718 | 1446 |
| 29719 | 1405 |
| 29720 | 1355 |
| 29721 | 1285 |
| 29722 | 1285 |
| 29723 | 1289 |
| 29724 | 1293 |
| 29725 | 1335 |
| 29726 | 1371 |
| 29727 | 1408 |
| 29728 | 1452 |
| 29729 | 1482 |
| 29730 | 1506 |
| 29731 | 1554 |
| 29732 | 1613 |
| 29733 | 1661 |
| 29734 | 1716 |
| 29735 | 1804 |
| 29736 | 1936 |
| 29737 | 2058 |
| 29738 | 2134 |
| 29739 | 2150 |
| 29740 | 2149 |
| 29741 | 2132 |
| 29742 | 2112 |
| 29743 | 2078 |
| 29744 | 2022 |
| 29745 | 1979 |
| 29746 | 1929 |
| 29747 | 1889 |
| 29748 | 1844 |
| 29749 | 1772 |
| 29750 | 1700 |
| 29751 | 1659 |
| 29752 | 1640 |
| 29753 | 1601 |
| 29754 | 1605 |
| 29755 | 1598 |
| 29756 | 1539 |
| 29757 | 1490 |
| 29758 | 1437 |
| 29759 | 1381 |
| 29760 | 1315 |
| 29761 | 1263 |
| 29762 | 1199 |
| 29763 | 1140 |
| 29764 | 1141 |
| 29765 | 1132 |
| 29766 | 1089 |
| 29767 | 1054 |
| 29768 | 1022 |
| 29769 | 994 |
| 29770 | 962 |
| 29771 | 934 |
| 29772 | 914 |
| 29773 | 890 |
| 29774 | 875 |
| 29775 | 860 |
| 29776 | 855 |
| 29777 | 841 |
| 29778 | 845 |
| 29779 | 847 |
| 29780 | 864 |
| 29781 | 851 |
| 29782 | 857 |
| 29783 | 865 |
| 29784 | 877 |
| 29785 | 866 |
| 29786 | 868 |
| 29787 | 852 |
| 29788 | 882 |
| 29789 | 897 |
| 29790 | 923 |
| 29791 | 954 |
| 29792 | 978 |
| 29793 | 1007 |
| 29794 | 1059 |
| 29795 | 1077 |
| 29796 | 1114 |
| 29797 | 1142 |
| 29798 | 1184 |
| 29799 | 1209 |
| 29800 | 1251 |
| 29801 | 1308 |
| 29802 | 1323 |
| 29803 | 1347 |
| 29804 | 1389 |
| 29805 | 1390 |
| 29806 | 1376 |
| 29807 | 1402 |
| 29808 | 1421 |
| 29809 | 1477 |
| 29810 | 1507 |
| 29811 | 1532 |
| 29812 | 1534 |
| 29813 | 1508 |
| 29814 | 1512 |
| 29815 | 1519 |
| 29816 | 1500 |
| 29817 | 1499 |
| 29818 | 1515 |
| 29819 | 1503 |
| 29820 | 1454 |
| 29821 | 1432 |
| 29822 | 1408 |
| 29823 | 1442 |
| 29824 | 1439 |
| 29825 | 1431 |
| 29826 | 1452 |
| 29827 | 1456 |
| 29828 | 1475 |
| 29829 | 1507 |
| 29830 | 1572 |
| 29831 | 1664 |
| 29832 | 1807 |
| 29833 | 1930 |
| 29834 | 1989 |
| 29835 | 2024 |
| 29836 | 2036 |
| 29837 | 2028 |
| 29838 | 2015 |
| 29839 | 1982 |
| 29840 | 1947 |
| 29841 | 1894 |
| 29842 | 1866 |
| 29843 | 1838 |
| 29844 | 1802 |
| 29845 | 1738 |
| 29846 | 1675 |
| 29847 | 1615 |
| 29848 | 1595 |
| 29849 | 1564 |
| 29850 | 1567 |
| 29851 | 1557 |
| 29852 | 1483 |
| 29853 | 1415 |
| 29854 | 1343 |
| 29855 | 1275 |
| 29856 | 1190 |
| 29857 | 1117 |
| 29858 | 1056 |
| 29859 | 998 |
| 29860 | 1013 |
| 29861 | 1015 |
| 29862 | 981 |
| 29863 | 951 |
| 29864 | 918 |
| 29865 | 890 |
| 29866 | 870 |
| 29867 | 847 |
| 29868 | 824 |
| 29869 | 800 |
| 29870 | 786 |
| 29871 | 781 |
| 29872 | 792 |
| 29873 | 785 |
| 29874 | 793 |
| 29875 | 803 |
| 29876 | 835 |
| 29877 | 843 |
| 29878 | 864 |
| 29879 | 889 |
| 29880 | 947 |
| 29881 | 977 |
| 29882 | 1030 |
| 29883 | 1098 |
| 29884 | 1252 |
| 29885 | 1325 |
| 29886 | 1414 |
| 29887 | 1503 |
| 29888 | 1577 |
| 29889 | 1608 |
| 29890 | 1604 |
| 29891 | 1632 |
| 29892 | 1666 |
| 29893 | 1683 |
| 29894 | 1697 |
| 29895 | 1680 |
| 29896 | 1671 |
| 29897 | 1678 |
| 29898 | 1680 |
| 29899 | 1686 |
| 29900 | 1718 |
| 29901 | 1734 |
| 29902 | 1703 |
| 29903 | 1675 |
| 29904 | 1679 |
| 29905 | 1710 |
| 29906 | 1775 |
| 29907 | 1802 |
| 29908 | 1773 |
| 29909 | 1693 |
| 29910 | 1677 |
| 29911 | 1708 |
| 29912 | 1717 |
| 29913 | 1705 |
| 29914 | 1700 |
| 29915 | 1687 |
| 29916 | 1702 |
| 29917 | 1715 |
| 29918 | 1676 |
| 29919 | 1663 |
| 29920 | 1701 |
| 29921 | 1713 |
| 29922 | 1737 |
| 29923 | 1760 |
| 29924 | 1801 |
| 29925 | 1843 |
| 29926 | 1889 |
| 29927 | 1973 |
| 29928 | 2089 |
| 29929 | 2152 |
| 29930 | 2191 |
| 29931 | 2218 |
| 29932 | 2224 |
| 29933 | 2208 |
| 29934 | 2203 |
| 29935 | 2190 |
| 29936 | 2149 |
| 29937 | 2108 |
| 29938 | 2072 |
| 29939 | 2034 |
| 29940 | 1981 |
| 29941 | 1913 |
| 29942 | 1839 |
| 29943 | 1780 |
| 29944 | 1741 |
| 29945 | 1686 |
| 29946 | 1686 |
| 29947 | 1664 |
| 29948 | 1577 |
| 29949 | 1483 |
| 29950 | 1402 |
| 29951 | 1320 |
| 29952 | 1230 |
| 29953 | 1152 |
| 29954 | 1083 |
| 29955 | 1037 |
| 29956 | 1062 |
| 29957 | 1069 |
| 29958 | 1032 |
| 29959 | 1001 |
| 29960 | 973 |
| 29961 | 943 |
| 29962 | 915 |
| 29963 | 891 |
| 29964 | 880 |
| 29965 | 868 |
| 29966 | 859 |
| 29967 | 850 |
| 29968 | 849 |
| 29969 | 848 |
| 29970 | 859 |
| 29971 | 871 |
| 29972 | 900 |
| 29973 | 900 |
| 29974 | 916 |
| 29975 | 949 |
| 29976 | 1004 |
| 29977 | 1022 |
| 29978 | 1079 |
| 29979 | 1134 |
| 29980 | 1261 |
| 29981 | 1351 |
| 29982 | 1430 |
| 29983 | 1503 |
| 29984 | 1593 |
| 29985 | 1603 |
| 29986 | 1624 |
| 29987 | 1646 |
| 29988 | 1684 |
| 29989 | 1690 |
| 29990 | 1688 |
| 29991 | 1689 |
| 29992 | 1690 |
| 29993 | 1703 |
| 29994 | 1700 |
| 29995 | 1705 |
| 29996 | 1717 |
| 29997 | 1733 |
| 29998 | 1750 |
| 29999 | 1756 |
| 30000 | 1759 |
| 30001 | 1782 |
| 30002 | 1820 |
| 30003 | 1840 |
| 30004 | 1813 |
| 30005 | 1784 |
| 30006 | 1717 |
| 30007 | 1711 |
| 30008 | 1723 |
| 30009 | 1747 |
| 30010 | 1717 |
| 30011 | 1630 |
| 30012 | 1676 |
| 30013 | 1690 |
| 30014 | 1695 |
| 30015 | 1678 |
| 30016 | 1676 |
| 30017 | 1709 |
| 30018 | 1735 |
| 30019 | 1761 |
| 30020 | 1777 |
| 30021 | 1821 |
| 30022 | 1881 |
| 30023 | 1961 |
| 30024 | 2067 |
| 30025 | 2147 |
| 30026 | 2197 |
| 30027 | 2231 |
| 30028 | 2229 |
| 30029 | 2211 |
| 30030 | 2196 |
| 30031 | 2191 |
| 30032 | 2167 |
| 30033 | 2122 |
| 30034 | 2090 |
| 30035 | 2055 |
| 30036 | 2002 |
| 30037 | 1933 |
| 30038 | 1871 |
| 30039 | 1805 |
| 30040 | 1769 |
| 30041 | 1721 |
| 30042 | 1721 |
| 30043 | 1686 |
| 30044 | 1598 |
| 30045 | 1514 |
| 30046 | 1430 |
| 30047 | 1349 |
| 30048 | 1261 |
| 30049 | 1183 |
| 30050 | 1114 |
| 30051 | 1063 |
| 30052 | 1085 |
| 30053 | 1083 |
| 30054 | 1051 |
| 30055 | 1024 |
| 30056 | 1000 |
| 30057 | 977 |
| 30058 | 951 |
| 30059 | 928 |
| 30060 | 912 |
| 30061 | 898 |
| 30062 | 886 |
| 30063 | 883 |
| 30064 | 884 |
| 30065 | 886 |
| 30066 | 895 |
| 30067 | 902 |
| 30068 | 930 |
| 30069 | 932 |
| 30070 | 954 |
| 30071 | 984 |
| 30072 | 1030 |
| 30073 | 1051 |
| 30074 | 1099 |
| 30075 | 1159 |
| 30076 | 1290 |
| 30077 | 1376 |
| 30078 | 1448 |
| 30079 | 1533 |
| 30080 | 1633 |
| 30081 | 1666 |
| 30082 | 1669 |
| 30083 | 1696 |
| 30084 | 1733 |
| 30085 | 1739 |
| 30086 | 1750 |
| 30087 | 1768 |
| 30088 | 1750 |
| 30089 | 1760 |
| 30090 | 1771 |
| 30091 | 1768 |
| 30092 | 1768 |
| 30093 | 1757 |
| 30094 | 1766 |
| 30095 | 1732 |
| 30096 | 1755 |
| 30097 | 1807 |
| 30098 | 1836 |
| 30099 | 1857 |
| 30100 | 1852 |
| 30101 | 1840 |
| 30102 | 1802 |
| 30103 | 1799 |
| 30104 | 1810 |
| 30105 | 1828 |
| 30106 | 1857 |
| 30107 | 1861 |
| 30108 | 1856 |
| 30109 | 1841 |
| 30110 | 1823 |
| 30111 | 1813 |
| 30112 | 1836 |
| 30113 | 1831 |
| 30114 | 1824 |
| 30115 | 1840 |
| 30116 | 1874 |
| 30117 | 1908 |
| 30118 | 1958 |
| 30119 | 2033 |
| 30120 | 2152 |
| 30121 | 2224 |
| 30122 | 2262 |
| 30123 | 2292 |
| 30124 | 2292 |
| 30125 | 2274 |
| 30126 | 2259 |
| 30127 | 2248 |
| 30128 | 2206 |
| 30129 | 2155 |
| 30130 | 2115 |
| 30131 | 2069 |
| 30132 | 2019 |
| 30133 | 1956 |
| 30134 | 1887 |
| 30135 | 1823 |
| 30136 | 1781 |
| 30137 | 1734 |
| 30138 | 1739 |
| 30139 | 1702 |
| 30140 | 1605 |
| 30141 | 1521 |
| 30142 | 1450 |
| 30143 | 1369 |
| 30144 | 1279 |
| 30145 | 1202 |
| 30146 | 1136 |
| 30147 | 1081 |
| 30148 | 1091 |
| 30149 | 1100 |
| 30150 | 1070 |
| 30151 | 1035 |
| 30152 | 1007 |
| 30153 | 982 |
| 30154 | 961 |
| 30155 | 937 |
| 30156 | 921 |
| 30157 | 905 |
| 30158 | 900 |
| 30159 | 895 |
| 30160 | 895 |
| 30161 | 890 |
| 30162 | 892 |
| 30163 | 900 |
| 30164 | 929 |
| 30165 | 932 |
| 30166 | 950 |
| 30167 | 976 |
| 30168 | 1029 |
| 30169 | 1055 |
| 30170 | 1105 |
| 30171 | 1158 |
| 30172 | 1297 |
| 30173 | 1383 |
| 30174 | 1461 |
| 30175 | 1543 |
| 30176 | 1637 |
| 30177 | 1662 |
| 30178 | 1676 |
| 30179 | 1703 |
| 30180 | 1741 |
| 30181 | 1750 |
| 30182 | 1754 |
| 30183 | 1763 |
| 30184 | 1753 |
| 30185 | 1733 |
| 30186 | 1720 |
| 30187 | 1712 |
| 30188 | 1699 |
| 30189 | 1697 |
| 30190 | 1676 |
| 30191 | 1675 |
| 30192 | 1717 |
| 30193 | 1749 |
| 30194 | 1771 |
| 30195 | 1783 |
| 30196 | 1754 |
| 30197 | 1695 |
| 30198 | 1631 |
| 30199 | 1632 |
| 30200 | 1665 |
| 30201 | 1666 |
| 30202 | 1684 |
| 30203 | 1679 |
| 30204 | 1679 |
| 30205 | 1647 |
| 30206 | 1642 |
| 30207 | 1655 |
| 30208 | 1678 |
| 30209 | 1698 |
| 30210 | 1723 |
| 30211 | 1756 |
| 30212 | 1797 |
| 30213 | 1838 |
| 30214 | 1900 |
| 30215 | 1986 |
| 30216 | 2095 |
| 30217 | 2199 |
| 30218 | 2252 |
| 30219 | 2288 |
| 30220 | 2273 |
| 30221 | 2259 |
| 30222 | 2243 |
| 30223 | 2226 |
| 30224 | 2197 |
| 30225 | 2156 |
| 30226 | 2119 |
| 30227 | 2075 |
| 30228 | 2025 |
| 30229 | 1960 |
| 30230 | 1893 |
| 30231 | 1828 |
| 30232 | 1785 |
| 30233 | 1747 |
| 30234 | 1745 |
| 30235 | 1720 |
| 30236 | 1634 |
| 30237 | 1560 |
| 30238 | 1484 |
| 30239 | 1410 |
| 30240 | 1324 |
| 30241 | 1247 |
| 30242 | 1179 |
| 30243 | 1115 |
| 30244 | 1133 |
| 30245 | 1137 |
| 30246 | 1100 |
| 30247 | 1074 |
| 30248 | 1044 |
| 30249 | 1017 |
| 30250 | 986 |
| 30251 | 972 |
| 30252 | 952 |
| 30253 | 938 |
| 30254 | 929 |
| 30255 | 919 |
| 30256 | 917 |
| 30257 | 915 |
| 30258 | 921 |
| 30259 | 927 |
| 30260 | 949 |
| 30261 | 952 |
| 30262 | 972 |
| 30263 | 995 |
| 30264 | 1043 |
| 30265 | 1064 |
| 30266 | 1107 |
| 30267 | 1160 |
| 30268 | 1289 |
| 30269 | 1368 |
| 30270 | 1449 |
| 30271 | 1527 |
| 30272 | 1615 |
| 30273 | 1652 |
| 30274 | 1654 |
| 30275 | 1687 |
| 30276 | 1713 |
| 30277 | 1712 |
| 30278 | 1692 |
| 30279 | 1667 |
| 30280 | 1621 |
| 30281 | 1584 |
| 30282 | 1593 |
| 30283 | 1594 |
| 30284 | 1557 |
| 30285 | 1527 |
| 30286 | 1522 |
| 30287 | 1553 |
| 30288 | 1600 |
| 30289 | 1635 |
| 30290 | 1667 |
| 30291 | 1697 |
| 30292 | 1688 |
| 30293 | 1656 |
| 30294 | 1638 |
| 30295 | 1619 |
| 30296 | 1592 |
| 30297 | 1591 |
| 30298 | 1608 |
| 30299 | 1599 |
| 30300 | 1604 |
| 30301 | 1630 |
| 30302 | 1637 |
| 30303 | 1651 |
| 30304 | 1666 |
| 30305 | 1680 |
| 30306 | 1699 |
| 30307 | 1734 |
| 30308 | 1779 |
| 30309 | 1824 |
| 30310 | 1892 |
| 30311 | 1981 |
| 30312 | 2136 |
| 30313 | 2221 |
| 30314 | 2271 |
| 30315 | 2295 |
| 30316 | 2278 |
| 30317 | 2247 |
| 30318 | 2230 |
| 30319 | 2209 |
| 30320 | 2175 |
| 30321 | 2121 |
| 30322 | 2062 |
| 30323 | 2006 |
| 30324 | 1965 |
| 30325 | 1905 |
| 30326 | 1851 |
| 30327 | 1793 |
| 30328 | 1767 |
| 30329 | 1728 |
| 30330 | 1729 |
| 30331 | 1702 |
| 30332 | 1618 |
| 30333 | 1569 |
| 30334 | 1497 |
| 30335 | 1429 |
| 30336 | 1354 |
| 30337 | 1291 |
| 30338 | 1223 |
| 30339 | 1166 |
| 30340 | 1181 |
| 30341 | 1178 |
| 30342 | 1141 |
| 30343 | 1109 |
| 30344 | 1074 |
| 30345 | 1042 |
| 30346 | 1006 |
| 30347 | 979 |
| 30348 | 957 |
| 30349 | 941 |
| 30350 | 927 |
| 30351 | 920 |
| 30352 | 916 |
| 30353 | 906 |
| 30354 | 904 |
| 30355 | 904 |
| 30356 | 917 |
| 30357 | 901 |
| 30358 | 908 |
| 30359 | 919 |
| 30360 | 938 |
| 30361 | 927 |
| 30362 | 929 |
| 30363 | 926 |
| 30364 | 999 |
| 30365 | 1042 |
| 30366 | 1091 |
| 30367 | 1148 |
| 30368 | 1224 |
| 30369 | 1274 |
| 30370 | 1298 |
| 30371 | 1355 |
| 30372 | 1409 |
| 30373 | 1454 |
| 30374 | 1501 |
| 30375 | 1533 |
| 30376 | 1549 |
| 30377 | 1573 |
| 30378 | 1609 |
| 30379 | 1628 |
| 30380 | 1660 |
| 30381 | 1678 |
| 30382 | 1690 |
| 30383 | 1663 |
| 30384 | 1620 |
| 30385 | 1666 |
| 30386 | 1723 |
| 30387 | 1764 |
| 30388 | 1742 |
| 30389 | 1756 |
| 30390 | 1726 |
| 30391 | 1675 |
| 30392 | 1601 |
| 30393 | 1502 |
| 30394 | 1488 |
| 30395 | 1476 |
| 30396 | 1476 |
| 30397 | 1518 |
| 30398 | 1549 |
| 30399 | 1583 |
| 30400 | 1613 |
| 30401 | 1631 |
| 30402 | 1638 |
| 30403 | 1673 |
| 30404 | 1721 |
| 30405 | 1770 |
| 30406 | 1824 |
| 30407 | 1921 |
| 30408 | 2054 |
| 30409 | 2140 |
| 30410 | 2182 |
| 30411 | 2185 |
| 30412 | 2171 |
| 30413 | 2154 |
| 30414 | 2139 |
| 30415 | 2104 |
| 30416 | 2040 |
| 30417 | 2000 |
| 30418 | 1956 |
| 30419 | 1922 |
| 30420 | 1876 |
| 30421 | 1804 |
| 30422 | 1736 |
| 30423 | 1687 |
| 30424 | 1670 |
| 30425 | 1633 |
| 30426 | 1642 |
| 30427 | 1637 |
| 30428 | 1581 |
| 30429 | 1531 |
| 30430 | 1485 |
| 30431 | 1429 |
| 30432 | 1362 |
| 30433 | 1312 |
| 30434 | 1246 |
| 30435 | 1181 |
| 30436 | 1193 |
| 30437 | 1188 |
| 30438 | 1137 |
| 30439 | 1100 |
| 30440 | 1067 |
| 30441 | 1032 |
| 30442 | 1006 |
| 30443 | 979 |
| 30444 | 955 |
| 30445 | 929 |
| 30446 | 915 |
| 30447 | 897 |
| 30448 | 888 |
| 30449 | 875 |
| 30450 | 882 |
| 30451 | 879 |
| 30452 | 896 |
| 30453 | 879 |
| 30454 | 882 |
| 30455 | 893 |
| 30456 | 904 |
| 30457 | 896 |
| 30458 | 895 |
| 30459 | 872 |
| 30460 | 903 |
| 30461 | 918 |
| 30462 | 942 |
| 30463 | 969 |
| 30464 | 1004 |
| 30465 | 1038 |
| 30466 | 1074 |
| 30467 | 1093 |
| 30468 | 1130 |
| 30469 | 1161 |
| 30470 | 1206 |
| 30471 | 1218 |
| 30472 | 1248 |
| 30473 | 1301 |
| 30474 | 1307 |
| 30475 | 1330 |
| 30476 | 1367 |
| 30477 | 1356 |
| 30478 | 1340 |
| 30479 | 1362 |
| 30480 | 1384 |
| 30481 | 1439 |
| 30482 | 1460 |
| 30483 | 1478 |
| 30484 | 1460 |
| 30485 | 1416 |
| 30486 | 1412 |
| 30487 | 1404 |
| 30488 | 1390 |
| 30489 | 1405 |
| 30490 | 1409 |
| 30491 | 1404 |
| 30492 | 1387 |
| 30493 | 1381 |
| 30494 | 1355 |
| 30495 | 1401 |
| 30496 | 1427 |
| 30497 | 1429 |
| 30498 | 1457 |
| 30499 | 1473 |
| 30500 | 1497 |
| 30501 | 1539 |
| 30502 | 1607 |
| 30503 | 1724 |
| 30504 | 1886 |
| 30505 | 1985 |
| 30506 | 2028 |
| 30507 | 2049 |
| 30508 | 2053 |
| 30509 | 2043 |
| 30510 | 2025 |
| 30511 | 1991 |
| 30512 | 1947 |
| 30513 | 1912 |
| 30514 | 1889 |
| 30515 | 1854 |
| 30516 | 1822 |
| 30517 | 1754 |
| 30518 | 1694 |
| 30519 | 1635 |
| 30520 | 1612 |
| 30521 | 1575 |
| 30522 | 1588 |
| 30523 | 1579 |
| 30524 | 1508 |
| 30525 | 1441 |
| 30526 | 1369 |
| 30527 | 1301 |
| 30528 | 1217 |
| 30529 | 1145 |
| 30530 | 1090 |
| 30531 | 1027 |
| 30532 | 1045 |
| 30533 | 1053 |
| 30534 | 1019 |
| 30535 | 991 |
| 30536 | 958 |
| 30537 | 934 |
| 30538 | 916 |
| 30539 | 895 |
| 30540 | 876 |
| 30541 | 864 |
| 30542 | 853 |
| 30543 | 846 |
| 30544 | 855 |
| 30545 | 850 |
| 30546 | 856 |
| 30547 | 863 |
| 30548 | 897 |
| 30549 | 904 |
| 30550 | 928 |
| 30551 | 953 |
| 30552 | 1010 |
| 30553 | 1043 |
| 30554 | 1092 |
| 30555 | 1159 |
| 30556 | 1300 |
| 30557 | 1385 |
| 30558 | 1468 |
| 30559 | 1543 |
| 30560 | 1642 |
| 30561 | 1693 |
| 30562 | 1702 |
| 30563 | 1730 |
| 30564 | 1755 |
| 30565 | 1759 |
| 30566 | 1767 |
| 30567 | 1763 |
| 30568 | 1744 |
| 30569 | 1751 |
| 30570 | 1763 |
| 30571 | 1759 |
| 30572 | 1777 |
| 30573 | 1790 |
| 30574 | 1751 |
| 30575 | 1737 |
| 30576 | 1748 |
| 30577 | 1766 |
| 30578 | 1831 |
| 30579 | 1861 |
| 30580 | 1830 |
| 30581 | 1739 |
| 30582 | 1715 |
| 30583 | 1750 |
| 30584 | 1768 |
| 30585 | 1747 |
| 30586 | 1743 |
| 30587 | 1747 |
| 30588 | 1778 |
| 30589 | 1790 |
| 30590 | 1766 |
| 30591 | 1765 |
| 30592 | 1781 |
| 30593 | 1787 |
| 30594 | 1797 |
| 30595 | 1817 |
| 30596 | 1848 |
| 30597 | 1888 |
| 30598 | 1936 |
| 30599 | 2044 |
| 30600 | 2157 |
| 30601 | 2232 |
| 30602 | 2274 |
| 30603 | 2303 |
| 30604 | 2292 |
| 30605 | 2276 |
| 30606 | 2275 |
| 30607 | 2255 |
| 30608 | 2207 |
| 30609 | 2161 |
| 30610 | 2121 |
| 30611 | 2078 |
| 30612 | 2027 |
| 30613 | 1958 |
| 30614 | 1892 |
| 30615 | 1826 |
| 30616 | 1788 |
| 30617 | 1739 |
| 30618 | 1752 |
| 30619 | 1719 |
| 30620 | 1637 |
| 30621 | 1557 |
| 30622 | 1472 |
| 30623 | 1385 |
| 30624 | 1295 |
| 30625 | 1221 |
| 30626 | 1159 |
| 30627 | 1101 |
| 30628 | 1123 |
| 30629 | 1135 |
| 30630 | 1096 |
| 30631 | 1063 |
| 30632 | 1033 |
| 30633 | 1005 |
| 30634 | 979 |
| 30635 | 954 |
| 30636 | 941 |
| 30637 | 930 |
| 30638 | 923 |
| 30639 | 917 |
| 30640 | 916 |
| 30641 | 913 |
| 30642 | 923 |
| 30643 | 929 |
| 30644 | 954 |
| 30645 | 961 |
| 30646 | 973 |
| 30647 | 1000 |
| 30648 | 1048 |
| 30649 | 1067 |
| 30650 | 1122 |
| 30651 | 1172 |
| 30652 | 1304 |
| 30653 | 1395 |
| 30654 | 1483 |
| 30655 | 1554 |
| 30656 | 1650 |
| 30657 | 1680 |
| 30658 | 1696 |
| 30659 | 1711 |
| 30660 | 1751 |
| 30661 | 1762 |
| 30662 | 1762 |
| 30663 | 1756 |
| 30664 | 1719 |
| 30665 | 1693 |
| 30666 | 1671 |
| 30667 | 1667 |
| 30668 | 1656 |
| 30669 | 1658 |
| 30670 | 1654 |
| 30671 | 1642 |
| 30672 | 1645 |
| 30673 | 1648 |
| 30674 | 1685 |
| 30675 | 1705 |
| 30676 | 1691 |
| 30677 | 1666 |
| 30678 | 1602 |
| 30679 | 1582 |
| 30680 | 1593 |
| 30681 | 1618 |
| 30682 | 1643 |
| 30683 | 1641 |
| 30684 | 1651 |
| 30685 | 1654 |
| 30686 | 1658 |
| 30687 | 1667 |
| 30688 | 1703 |
| 30689 | 1744 |
| 30690 | 1776 |
| 30691 | 1814 |
| 30692 | 1842 |
| 30693 | 1883 |
| 30694 | 1952 |
| 30695 | 2045 |
| 30696 | 2148 |
| 30697 | 2199 |
| 30698 | 2238 |
| 30699 | 2267 |
| 30700 | 2260 |
| 30701 | 2246 |
| 30702 | 2232 |
| 30703 | 2227 |
| 30704 | 2203 |
| 30705 | 2162 |
| 30706 | 2128 |
| 30707 | 2095 |
| 30708 | 2033 |
| 30709 | 1967 |
| 30710 | 1910 |
| 30711 | 1838 |
| 30712 | 1802 |
| 30713 | 1752 |
| 30714 | 1759 |
| 30715 | 1720 |
| 30716 | 1635 |
| 30717 | 1559 |
| 30718 | 1479 |
| 30719 | 1400 |
| 30720 | 1305 |
| 30721 | 1225 |
| 30722 | 1160 |
| 30723 | 1108 |
| 30724 | 1138 |
| 30725 | 1138 |
| 30726 | 1099 |
| 30727 | 1067 |
| 30728 | 1046 |
| 30729 | 1022 |
| 30730 | 1004 |
| 30731 | 984 |
| 30732 | 968 |
| 30733 | 951 |
| 30734 | 938 |
| 30735 | 935 |
| 30736 | 934 |
| 30737 | 924 |
| 30738 | 928 |
| 30739 | 937 |
| 30740 | 967 |
| 30741 | 969 |
| 30742 | 988 |
| 30743 | 1020 |
| 30744 | 1064 |
| 30745 | 1083 |
| 30746 | 1133 |
| 30747 | 1187 |
| 30748 | 1321 |
| 30749 | 1411 |
| 30750 | 1484 |
| 30751 | 1565 |
| 30752 | 1671 |
| 30753 | 1715 |
| 30754 | 1719 |
| 30755 | 1736 |
| 30756 | 1765 |
| 30757 | 1771 |
| 30758 | 1778 |
| 30759 | 1785 |
| 30760 | 1773 |
| 30761 | 1771 |
| 30762 | 1777 |
| 30763 | 1772 |
| 30764 | 1778 |
| 30765 | 1776 |
| 30766 | 1777 |
| 30767 | 1773 |
| 30768 | 1773 |
| 30769 | 1783 |
| 30770 | 1801 |
| 30771 | 1816 |
| 30772 | 1793 |
| 30773 | 1755 |
| 30774 | 1715 |
| 30775 | 1711 |
| 30776 | 1705 |
| 30777 | 1753 |
| 30778 | 1786 |
| 30779 | 1814 |
| 30780 | 1823 |
| 30781 | 1824 |
| 30782 | 1825 |
| 30783 | 1834 |
| 30784 | 1845 |
| 30785 | 1842 |
| 30786 | 1851 |
| 30787 | 1869 |
| 30788 | 1910 |
| 30789 | 1950 |
| 30790 | 2002 |
| 30791 | 2112 |
| 30792 | 2215 |
| 30793 | 2279 |
| 30794 | 2318 |
| 30795 | 2335 |
| 30796 | 2328 |
| 30797 | 2316 |
| 30798 | 2304 |
| 30799 | 2278 |
| 30800 | 2241 |
| 30801 | 2190 |
| 30802 | 2152 |
| 30803 | 2103 |
| 30804 | 2045 |
| 30805 | 1984 |
| 30806 | 1911 |
| 30807 | 1850 |
| 30808 | 1816 |
| 30809 | 1766 |
| 30810 | 1777 |
| 30811 | 1743 |
| 30812 | 1647 |
| 30813 | 1562 |
| 30814 | 1486 |
| 30815 | 1407 |
| 30816 | 1312 |
| 30817 | 1240 |
| 30818 | 1178 |
| 30819 | 1122 |
| 30820 | 1141 |
| 30821 | 1147 |
| 30822 | 1119 |
| 30823 | 1085 |
| 30824 | 1055 |
| 30825 | 1023 |
| 30826 | 995 |
| 30827 | 966 |
| 30828 | 950 |
| 30829 | 936 |
| 30830 | 928 |
| 30831 | 921 |
| 30832 | 922 |
| 30833 | 914 |
| 30834 | 919 |
| 30835 | 926 |
| 30836 | 955 |
| 30837 | 962 |
| 30838 | 984 |
| 30839 | 1007 |
| 30840 | 1061 |
| 30841 | 1085 |
| 30842 | 1132 |
| 30843 | 1189 |
| 30844 | 1325 |
| 30845 | 1416 |
| 30846 | 1493 |
| 30847 | 1577 |
| 30848 | 1671 |
| 30849 | 1716 |
| 30850 | 1733 |
| 30851 | 1743 |
| 30852 | 1777 |
| 30853 | 1780 |
| 30854 | 1781 |
| 30855 | 1781 |
| 30856 | 1764 |
| 30857 | 1745 |
| 30858 | 1747 |
| 30859 | 1729 |
| 30860 | 1713 |
| 30861 | 1723 |
| 30862 | 1726 |
| 30863 | 1737 |
| 30864 | 1778 |
| 30865 | 1814 |
| 30866 | 1819 |
| 30867 | 1800 |
| 30868 | 1787 |
| 30869 | 1777 |
| 30870 | 1760 |
| 30871 | 1743 |
| 30872 | 1731 |
| 30873 | 1725 |
| 30874 | 1743 |
| 30875 | 1747 |
| 30876 | 1762 |
| 30877 | 1763 |
| 30878 | 1775 |
| 30879 | 1778 |
| 30880 | 1790 |
| 30881 | 1802 |
| 30882 | 1821 |
| 30883 | 1844 |
| 30884 | 1887 |
| 30885 | 1932 |
| 30886 | 1993 |
| 30887 | 2091 |
| 30888 | 2184 |
| 30889 | 2246 |
| 30890 | 2288 |
| 30891 | 2318 |
| 30892 | 2295 |
| 30893 | 2284 |
| 30894 | 2260 |
| 30895 | 2246 |
| 30896 | 2211 |
| 30897 | 2170 |
| 30898 | 2131 |
| 30899 | 2094 |
| 30900 | 2048 |
| 30901 | 1982 |
| 30902 | 1913 |
| 30903 | 1851 |
| 30904 | 1818 |
| 30905 | 1777 |
| 30906 | 1774 |
| 30907 | 1745 |
| 30908 | 1660 |
| 30909 | 1572 |
| 30910 | 1495 |
| 30911 | 1418 |
| 30912 | 1336 |
| 30913 | 1266 |
| 30914 | 1201 |
| 30915 | 1138 |
| 30916 | 1161 |
| 30917 | 1158 |
| 30918 | 1119 |
| 30919 | 1088 |
| 30920 | 1052 |
| 30921 | 1025 |
| 30922 | 992 |
| 30923 | 974 |
| 30924 | 954 |
| 30925 | 941 |
| 30926 | 932 |
| 30927 | 922 |
| 30928 | 918 |
| 30929 | 916 |
| 30930 | 922 |
| 30931 | 927 |
| 30932 | 947 |
| 30933 | 949 |
| 30934 | 964 |
| 30935 | 989 |
| 30936 | 1041 |
| 30937 | 1071 |
| 30938 | 1111 |
| 30939 | 1165 |
| 30940 | 1290 |
| 30941 | 1374 |
| 30942 | 1450 |
| 30943 | 1525 |
| 30944 | 1630 |
| 30945 | 1687 |
| 30946 | 1707 |
| 30947 | 1729 |
| 30948 | 1761 |
| 30949 | 1770 |
| 30950 | 1751 |
| 30951 | 1760 |
| 30952 | 1731 |
| 30953 | 1691 |
| 30954 | 1697 |
| 30955 | 1691 |
| 30956 | 1663 |
| 30957 | 1658 |
| 30958 | 1653 |
| 30959 | 1656 |
| 30960 | 1682 |
| 30961 | 1695 |
| 30962 | 1726 |
| 30963 | 1750 |
| 30964 | 1738 |
| 30965 | 1703 |
| 30966 | 1677 |
| 30967 | 1650 |
| 30968 | 1615 |
| 30969 | 1608 |
| 30970 | 1626 |
| 30971 | 1620 |
| 30972 | 1627 |
| 30973 | 1636 |
| 30974 | 1638 |
| 30975 | 1656 |
| 30976 | 1686 |
| 30977 | 1705 |
| 30978 | 1732 |
| 30979 | 1767 |
| 30980 | 1813 |
| 30981 | 1867 |
| 30982 | 1940 |
| 30983 | 2040 |
| 30984 | 2174 |
| 30985 | 2233 |
| 30986 | 2276 |
| 30987 | 2294 |
| 30988 | 2268 |
| 30989 | 2240 |
| 30990 | 2226 |
| 30991 | 2214 |
| 30992 | 2186 |
| 30993 | 2130 |
| 30994 | 2076 |
| 30995 | 2020 |
| 30996 | 1983 |
| 30997 | 1926 |
| 30998 | 1872 |
| 30999 | 1818 |
| 31000 | 1797 |
| 31001 | 1765 |
| 31002 | 1774 |
| 31003 | 1755 |
| 31004 | 1677 |
| 31005 | 1619 |
| 31006 | 1554 |
| 31007 | 1483 |
| 31008 | 1402 |
| 31009 | 1344 |
| 31010 | 1275 |
| 31011 | 1211 |
| 31012 | 1225 |
| 31013 | 1226 |
| 31014 | 1183 |
| 31015 | 1147 |
| 31016 | 1114 |
| 31017 | 1080 |
| 31018 | 1038 |
| 31019 | 1011 |
| 31020 | 986 |
| 31021 | 970 |
| 31022 | 957 |
| 31023 | 950 |
| 31024 | 948 |
| 31025 | 933 |
| 31026 | 929 |
| 31027 | 926 |
| 31028 | 939 |
| 31029 | 933 |
| 31030 | 945 |
| 31031 | 952 |
| 31032 | 968 |
| 31033 | 956 |
| 31034 | 951 |
| 31035 | 948 |
| 31036 | 1018 |
| 31037 | 1061 |
| 31038 | 1113 |
| 31039 | 1173 |
| 31040 | 1252 |
| 31041 | 1315 |
| 31042 | 1350 |
| 31043 | 1405 |
| 31044 | 1465 |
| 31045 | 1517 |
| 31046 | 1559 |
| 31047 | 1603 |
| 31048 | 1639 |
| 31049 | 1688 |
| 31050 | 1717 |
| 31051 | 1744 |
| 31052 | 1771 |
| 31053 | 1802 |
| 31054 | 1834 |
| 31055 | 1836 |
| 31056 | 1836 |
| 31057 | 1870 |
| 31058 | 1896 |
| 31059 | 1914 |
| 31060 | 1888 |
| 31061 | 1886 |
| 31062 | 1854 |
| 31063 | 1792 |
| 31064 | 1721 |
| 31065 | 1625 |
| 31066 | 1629 |
| 31067 | 1630 |
| 31068 | 1621 |
| 31069 | 1652 |
| 31070 | 1688 |
| 31071 | 1712 |
| 31072 | 1742 |
| 31073 | 1755 |
| 31074 | 1765 |
| 31075 | 1788 |
| 31076 | 1826 |
| 31077 | 1877 |
| 31078 | 1937 |
| 31079 | 2036 |
| 31080 | 2134 |
| 31081 | 2181 |
| 31082 | 2207 |
| 31083 | 2211 |
| 31084 | 2194 |
| 31085 | 2177 |
| 31086 | 2161 |
| 31087 | 2126 |
| 31088 | 2069 |
| 31089 | 2024 |
| 31090 | 1981 |
| 31091 | 1952 |
| 31092 | 1908 |
| 31093 | 1838 |
| 31094 | 1780 |
| 31095 | 1729 |
| 31096 | 1721 |
| 31097 | 1694 |
| 31098 | 1707 |
| 31099 | 1701 |
| 31100 | 1641 |
| 31101 | 1591 |
| 31102 | 1546 |
| 31103 | 1493 |
| 31104 | 1420 |
| 31105 | 1364 |
| 31106 | 1299 |
| 31107 | 1231 |
| 31108 | 1248 |
| 31109 | 1243 |
| 31110 | 1192 |
| 31111 | 1154 |
| 31112 | 1117 |
| 31113 | 1078 |
| 31114 | 1048 |
| 31115 | 1021 |
| 31116 | 998 |
| 31117 | 973 |
| 31118 | 957 |
| 31119 | 940 |
| 31120 | 930 |
| 31121 | 921 |
| 31122 | 923 |
| 31123 | 920 |
| 31124 | 931 |
| 31125 | 927 |
| 31126 | 921 |
| 31127 | 931 |
| 31128 | 936 |
| 31129 | 926 |
| 31130 | 927 |
| 31131 | 905 |
| 31132 | 936 |
| 31133 | 948 |
| 31134 | 970 |
| 31135 | 992 |
| 31136 | 1035 |
| 31137 | 1087 |
| 31138 | 1117 |
| 31139 | 1144 |
| 31140 | 1187 |
| 31141 | 1232 |
| 31142 | 1290 |
| 31143 | 1324 |
| 31144 | 1374 |
| 31145 | 1423 |
| 31146 | 1450 |
| 31147 | 1487 |
| 31148 | 1515 |
| 31149 | 1538 |
| 31150 | 1565 |
| 31151 | 1585 |
| 31152 | 1615 |
| 31153 | 1660 |
| 31154 | 1689 |
| 31155 | 1710 |
| 31156 | 1687 |
| 31157 | 1657 |
| 31158 | 1617 |
| 31159 | 1582 |
| 31160 | 1560 |
| 31161 | 1560 |
| 31162 | 1569 |
| 31163 | 1562 |
| 31164 | 1552 |
| 31165 | 1545 |
| 31166 | 1527 |
| 31167 | 1535 |
| 31168 | 1551 |
| 31169 | 1538 |
| 31170 | 1552 |
| 31171 | 1561 |
| 31172 | 1586 |
| 31173 | 1630 |
| 31174 | 1713 |
| 31175 | 1827 |
| 31176 | 1955 |
| 31177 | 2023 |
| 31178 | 2059 |
| 31179 | 2076 |
| 31180 | 2072 |
| 31181 | 2068 |
| 31182 | 2045 |
| 31183 | 2017 |
| 31184 | 1985 |
| 31185 | 1959 |
| 31186 | 1937 |
| 31187 | 1892 |
| 31188 | 1870 |
| 31189 | 1801 |
| 31190 | 1742 |
| 31191 | 1678 |
| 31192 | 1656 |
| 31193 | 1621 |
| 31194 | 1625 |
| 31195 | 1626 |
| 31196 | 1551 |
| 31197 | 1486 |
| 31198 | 1408 |
| 31199 | 1344 |
| 31200 | 1264 |
| 31201 | 1203 |
| 31202 | 1139 |
| 31203 | 1075 |
| 31204 | 1091 |
| 31205 | 1094 |
| 31206 | 1059 |
| 31207 | 1027 |
| 31208 | 995 |
| 31209 | 966 |
| 31210 | 945 |
| 31211 | 922 |
| 31212 | 906 |
| 31213 | 889 |
| 31214 | 881 |
| 31215 | 875 |
| 31216 | 878 |
| 31217 | 878 |
| 31218 | 881 |
| 31219 | 883 |
| 31220 | 906 |
| 31221 | 910 |
| 31222 | 937 |
| 31223 | 964 |
| 31224 | 1030 |
| 31225 | 1060 |
| 31226 | 1112 |
| 31227 | 1171 |
| 31228 | 1303 |
| 31229 | 1391 |
| 31230 | 1481 |
| 31231 | 1548 |
| 31232 | 1662 |
| 31233 | 1712 |
| 31234 | 1741 |
| 31235 | 1776 |
| 31236 | 1794 |
| 31237 | 1801 |
| 31238 | 1804 |
| 31239 | 1808 |
| 31240 | 1784 |
| 31241 | 1786 |
| 31242 | 1798 |
| 31243 | 1795 |
| 31244 | 1807 |
| 31245 | 1817 |
| 31246 | 1780 |
| 31247 | 1764 |
| 31248 | 1772 |
| 31249 | 1789 |
| 31250 | 1850 |
| 31251 | 1884 |
| 31252 | 1859 |
| 31253 | 1770 |
| 31254 | 1745 |
| 31255 | 1783 |
| 31256 | 1801 |
| 31257 | 1778 |
| 31258 | 1782 |
| 31259 | 1790 |
| 31260 | 1827 |
| 31261 | 1839 |
| 31262 | 1814 |
| 31263 | 1810 |
| 31264 | 1821 |
| 31265 | 1823 |
| 31266 | 1834 |
| 31267 | 1848 |
| 31268 | 1894 |
| 31269 | 1948 |
| 31270 | 2010 |
| 31271 | 2114 |
| 31272 | 2205 |
| 31273 | 2269 |
| 31274 | 2311 |
| 31275 | 2336 |
| 31276 | 2322 |
| 31277 | 2309 |
| 31278 | 2304 |
| 31279 | 2285 |
| 31280 | 2242 |
| 31281 | 2207 |
| 31282 | 2169 |
| 31283 | 2124 |
| 31284 | 2078 |
| 31285 | 2005 |
| 31286 | 1938 |
| 31287 | 1876 |
| 31288 | 1846 |
| 31289 | 1792 |
| 31290 | 1806 |
| 31291 | 1776 |
| 31292 | 1693 |
| 31293 | 1612 |
| 31294 | 1525 |
| 31295 | 1435 |
| 31296 | 1341 |
| 31297 | 1269 |
| 31298 | 1201 |
| 31299 | 1150 |
| 31300 | 1176 |
| 31301 | 1192 |
| 31302 | 1149 |
| 31303 | 1111 |
| 31304 | 1085 |
| 31305 | 1061 |
| 31306 | 1039 |
| 31307 | 1013 |
| 31308 | 994 |
| 31309 | 980 |
| 31310 | 973 |
| 31311 | 967 |
| 31312 | 967 |
| 31313 | 965 |
| 31314 | 974 |
| 31315 | 976 |
| 31316 | 997 |
| 31317 | 1005 |
| 31318 | 1017 |
| 31319 | 1047 |
| 31320 | 1092 |
| 31321 | 1108 |
| 31322 | 1164 |
| 31323 | 1208 |
| 31324 | 1347 |
| 31325 | 1440 |
| 31326 | 1522 |
| 31327 | 1593 |
| 31328 | 1689 |
| 31329 | 1741 |
| 31330 | 1769 |
| 31331 | 1796 |
| 31332 | 1830 |
| 31333 | 1845 |
| 31334 | 1846 |
| 31335 | 1835 |
| 31336 | 1791 |
| 31337 | 1763 |
| 31338 | 1747 |
| 31339 | 1745 |
| 31340 | 1729 |
| 31341 | 1728 |
| 31342 | 1725 |
| 31343 | 1725 |
| 31344 | 1741 |
| 31345 | 1752 |
| 31346 | 1779 |
| 31347 | 1800 |
| 31348 | 1778 |
| 31349 | 1755 |
| 31350 | 1733 |
| 31351 | 1716 |
| 31352 | 1713 |
| 31353 | 1736 |
| 31354 | 1764 |
| 31355 | 1746 |
| 31356 | 1756 |
| 31357 | 1767 |
| 31358 | 1775 |
| 31359 | 1787 |
| 31360 | 1825 |
| 31361 | 1858 |
| 31362 | 1878 |
| 31363 | 1910 |
| 31364 | 1938 |
| 31365 | 1980 |
| 31366 | 2052 |
| 31367 | 2155 |
| 31368 | 2243 |
| 31369 | 2294 |
| 31370 | 2333 |
| 31371 | 2362 |
| 31372 | 2354 |
| 31373 | 2345 |
| 31374 | 2332 |
| 31375 | 2318 |
| 31376 | 2290 |
| 31377 | 2248 |
| 31378 | 2205 |
| 31379 | 2162 |
| 31380 | 2102 |
| 31381 | 2034 |
| 31382 | 1969 |
| 31383 | 1890 |
| 31384 | 1860 |
| 31385 | 1810 |
| 31386 | 1824 |
| 31387 | 1784 |
| 31388 | 1694 |
| 31389 | 1628 |
| 31390 | 1551 |
| 31391 | 1468 |
| 31392 | 1377 |
| 31393 | 1298 |
| 31394 | 1232 |
| 31395 | 1176 |
| 31396 | 1205 |
| 31397 | 1209 |
| 31398 | 1172 |
| 31399 | 1133 |
| 31400 | 1110 |
| 31401 | 1082 |
| 31402 | 1061 |
| 31403 | 1042 |
| 31404 | 1027 |
| 31405 | 1009 |
| 31406 | 995 |
| 31407 | 988 |
| 31408 | 985 |
| 31409 | 974 |
| 31410 | 974 |
| 31411 | 981 |
| 31412 | 1012 |
| 31413 | 1012 |
| 31414 | 1027 |
| 31415 | 1056 |
| 31416 | 1105 |
| 31417 | 1118 |
| 31418 | 1167 |
| 31419 | 1215 |
| 31420 | 1349 |
| 31421 | 1447 |
| 31422 | 1523 |
| 31423 | 1606 |
| 31424 | 1707 |
| 31425 | 1764 |
| 31426 | 1785 |
| 31427 | 1791 |
| 31428 | 1814 |
| 31429 | 1819 |
| 31430 | 1832 |
| 31431 | 1835 |
| 31432 | 1824 |
| 31433 | 1810 |
| 31434 | 1809 |
| 31435 | 1804 |
| 31436 | 1807 |
| 31437 | 1801 |
| 31438 | 1806 |
| 31439 | 1810 |
| 31440 | 1813 |
| 31441 | 1817 |
| 31442 | 1825 |
| 31443 | 1823 |
| 31444 | 1775 |
| 31445 | 1731 |
| 31446 | 1688 |
| 31447 | 1678 |
| 31448 | 1677 |
| 31449 | 1738 |
| 31450 | 1774 |
| 31451 | 1805 |
| 31452 | 1821 |
| 31453 | 1834 |
| 31454 | 1846 |
| 31455 | 1854 |
| 31456 | 1871 |
| 31457 | 1882 |
| 31458 | 1905 |
| 31459 | 1925 |
| 31460 | 1962 |
| 31461 | 2005 |
| 31462 | 2053 |
| 31463 | 2177 |
| 31464 | 2275 |
| 31465 | 2325 |
| 31466 | 2371 |
| 31467 | 2381 |
| 31468 | 2374 |
| 31469 | 2368 |
| 31470 | 2357 |
| 31471 | 2331 |
| 31472 | 2297 |
| 31473 | 2250 |
| 31474 | 2209 |
| 31475 | 2163 |
| 31476 | 2108 |
| 31477 | 2048 |
| 31478 | 1976 |
| 31479 | 1914 |
| 31480 | 1870 |
| 31481 | 1823 |
| 31482 | 1841 |
| 31483 | 1814 |
| 31484 | 1724 |
| 31485 | 1637 |
| 31486 | 1557 |
| 31487 | 1477 |
| 31488 | 1373 |
| 31489 | 1299 |
| 31490 | 1235 |
| 31491 | 1173 |
| 31492 | 1203 |
| 31493 | 1213 |
| 31494 | 1185 |
| 31495 | 1150 |
| 31496 | 1120 |
| 31497 | 1086 |
| 31498 | 1056 |
| 31499 | 1026 |
| 31500 | 1009 |
| 31501 | 992 |
| 31502 | 983 |
| 31503 | 973 |
| 31504 | 972 |
| 31505 | 961 |
| 31506 | 963 |
| 31507 | 972 |
| 31508 | 998 |
| 31509 | 1001 |
| 31510 | 1022 |
| 31511 | 1042 |
| 31512 | 1102 |
| 31513 | 1122 |
| 31514 | 1169 |
| 31515 | 1221 |
| 31516 | 1354 |
| 31517 | 1448 |
| 31518 | 1531 |
| 31519 | 1618 |
| 31520 | 1710 |
| 31521 | 1776 |
| 31522 | 1811 |
| 31523 | 1823 |
| 31524 | 1847 |
| 31525 | 1853 |
| 31526 | 1862 |
| 31527 | 1870 |
| 31528 | 1852 |
| 31529 | 1841 |
| 31530 | 1853 |
| 31531 | 1848 |
| 31532 | 1852 |
| 31533 | 1860 |
| 31534 | 1864 |
| 31535 | 1877 |
| 31536 | 1908 |
| 31537 | 1934 |
| 31538 | 1938 |
| 31539 | 1909 |
| 31540 | 1896 |
| 31541 | 1885 |
| 31542 | 1870 |
| 31543 | 1855 |
| 31544 | 1835 |
| 31545 | 1835 |
| 31546 | 1856 |
| 31547 | 1855 |
| 31548 | 1870 |
| 31549 | 1875 |
| 31550 | 1882 |
| 31551 | 1881 |
| 31552 | 1899 |
| 31553 | 1906 |
| 31554 | 1923 |
| 31555 | 1939 |
| 31556 | 1977 |
| 31557 | 2023 |
| 31558 | 2084 |
| 31559 | 2194 |
| 31560 | 2268 |
| 31561 | 2317 |
| 31562 | 2356 |
| 31563 | 2378 |
| 31564 | 2343 |
| 31565 | 2342 |
| 31566 | 2326 |
| 31567 | 2318 |
| 31568 | 2279 |
| 31569 | 2239 |
| 31570 | 2190 |
| 31571 | 2157 |
| 31572 | 2119 |
| 31573 | 2051 |
| 31574 | 1976 |
| 31575 | 1917 |
| 31576 | 1885 |
| 31577 | 1849 |
| 31578 | 1850 |
| 31579 | 1820 |
| 31580 | 1736 |
| 31581 | 1646 |
| 31582 | 1570 |
| 31583 | 1482 |
| 31584 | 1402 |
| 31585 | 1336 |
| 31586 | 1274 |
| 31587 | 1209 |
| 31588 | 1241 |
| 31589 | 1240 |
| 31590 | 1199 |
| 31591 | 1163 |
| 31592 | 1124 |
| 31593 | 1096 |
| 31594 | 1066 |
| 31595 | 1048 |
| 31596 | 1028 |
| 31597 | 1014 |
| 31598 | 1001 |
| 31599 | 993 |
| 31600 | 984 |
| 31601 | 982 |
| 31602 | 985 |
| 31603 | 989 |
| 31604 | 1009 |
| 31605 | 1009 |
| 31606 | 1022 |
| 31607 | 1048 |
| 31608 | 1096 |
| 31609 | 1131 |
| 31610 | 1171 |
| 31611 | 1215 |
| 31612 | 1343 |
| 31613 | 1435 |
| 31614 | 1512 |
| 31615 | 1590 |
| 31616 | 1693 |
| 31617 | 1753 |
| 31618 | 1785 |
| 31619 | 1815 |
| 31620 | 1838 |
| 31621 | 1845 |
| 31622 | 1839 |
| 31623 | 1850 |
| 31624 | 1829 |
| 31625 | 1792 |
| 31626 | 1794 |
| 31627 | 1782 |
| 31628 | 1751 |
| 31629 | 1741 |
| 31630 | 1729 |
| 31631 | 1733 |
| 31632 | 1756 |
| 31633 | 1758 |
| 31634 | 1787 |
| 31635 | 1811 |
| 31636 | 1796 |
| 31637 | 1762 |
| 31638 | 1744 |
| 31639 | 1714 |
| 31640 | 1686 |
| 31641 | 1696 |
| 31642 | 1723 |
| 31643 | 1721 |
| 31644 | 1737 |
| 31645 | 1746 |
| 31646 | 1750 |
| 31647 | 1766 |
| 31648 | 1794 |
| 31649 | 1813 |
| 31650 | 1839 |
| 31651 | 1876 |
| 31652 | 1924 |
| 31653 | 1979 |
| 31654 | 2054 |
| 31655 | 2151 |
| 31656 | 2252 |
| 31657 | 2294 |
| 31658 | 2321 |
| 31659 | 2334 |
| 31660 | 2314 |
| 31661 | 2287 |
| 31662 | 2271 |
| 31663 | 2253 |
| 31664 | 2221 |
| 31665 | 2172 |
| 31666 | 2128 |
| 31667 | 2076 |
| 31668 | 2036 |
| 31669 | 1977 |
| 31670 | 1918 |
| 31671 | 1868 |
| 31672 | 1859 |
| 31673 | 1832 |
| 31674 | 1841 |
| 31675 | 1823 |
| 31676 | 1749 |
| 31677 | 1687 |
| 31678 | 1625 |
| 31679 | 1555 |
| 31680 | 1478 |
| 31681 | 1415 |
| 31682 | 1351 |
| 31683 | 1290 |
| 31684 | 1313 |
| 31685 | 1319 |
| 31686 | 1272 |
| 31687 | 1229 |
| 31688 | 1187 |
| 31689 | 1152 |
| 31690 | 1113 |
| 31691 | 1085 |
| 31692 | 1057 |
| 31693 | 1040 |
| 31694 | 1031 |
| 31695 | 1017 |
| 31696 | 1011 |
| 31697 | 997 |
| 31698 | 990 |
| 31699 | 985 |
| 31700 | 999 |
| 31701 | 1000 |
| 31702 | 1005 |
| 31703 | 1008 |
| 31704 | 1020 |
| 31705 | 1015 |
| 31706 | 1023 |
| 31707 | 1021 |
| 31708 | 1093 |
| 31709 | 1137 |
| 31710 | 1186 |
| 31711 | 1236 |
| 31712 | 1307 |
| 31713 | 1369 |
| 31714 | 1417 |
| 31715 | 1464 |
| 31716 | 1515 |
| 31717 | 1570 |
| 31718 | 1612 |
| 31719 | 1656 |
| 31720 | 1686 |
| 31721 | 1731 |
| 31722 | 1759 |
| 31723 | 1788 |
| 31724 | 1815 |
| 31725 | 1855 |
| 31726 | 1887 |
| 31727 | 1900 |
| 31728 | 1922 |
| 31729 | 1949 |
| 31730 | 1968 |
| 31731 | 1972 |
| 31732 | 1961 |
| 31733 | 1944 |
| 31734 | 1925 |
| 31735 | 1887 |
| 31736 | 1854 |
| 31737 | 1815 |
| 31738 | 1823 |
| 31739 | 1804 |
| 31740 | 1792 |
| 31741 | 1781 |
| 31742 | 1787 |
| 31743 | 1789 |
| 31744 | 1795 |
| 31745 | 1808 |
| 31746 | 1819 |
| 31747 | 1843 |
| 31748 | 1881 |
| 31749 | 1936 |
| 31750 | 1999 |
| 31751 | 2107 |
| 31752 | 2177 |
| 31753 | 2214 |
| 31754 | 2234 |
| 31755 | 2239 |
| 31756 | 2223 |
| 31757 | 2203 |
| 31758 | 2180 |
| 31759 | 2146 |
| 31760 | 2096 |
| 31761 | 2058 |
| 31762 | 2016 |
| 31763 | 1989 |
| 31764 | 1944 |
| 31765 | 1881 |
| 31766 | 1825 |
| 31767 | 1775 |
| 31768 | 1772 |
| 31769 | 1750 |
| 31770 | 1775 |
| 31771 | 1772 |
| 31772 | 1709 |
| 31773 | 1654 |
| 31774 | 1612 |
| 31775 | 1558 |
| 31776 | 1484 |
| 31777 | 1421 |
| 31778 | 1358 |
| 31779 | 1289 |
| 31780 | 1318 |
| 31781 | 1317 |
| 31782 | 1265 |
| 31783 | 1218 |
| 31784 | 1180 |
| 31785 | 1138 |
| 31786 | 1105 |
| 31787 | 1071 |
| 31788 | 1047 |
| 31789 | 1025 |
| 31790 | 1008 |
| 31791 | 991 |
| 31792 | 982 |
| 31793 | 972 |
| 31794 | 969 |
| 31795 | 965 |
| 31796 | 975 |
| 31797 | 972 |
| 31798 | 963 |
| 31799 | 967 |
| 31800 | 972 |
| 31801 | 964 |
| 31802 | 964 |
| 31803 | 937 |
| 31804 | 969 |
| 31805 | 981 |
| 31806 | 1005 |
| 31807 | 1027 |
| 31808 | 1077 |
| 31809 | 1131 |
| 31810 | 1161 |
| 31811 | 1197 |
| 31812 | 1238 |
| 31813 | 1292 |
| 31814 | 1344 |
| 31815 | 1381 |
| 31816 | 1416 |
| 31817 | 1454 |
| 31818 | 1476 |
| 31819 | 1513 |
| 31820 | 1535 |
| 31821 | 1546 |
| 31822 | 1564 |
| 31823 | 1565 |
| 31824 | 1584 |
| 31825 | 1644 |
| 31826 | 1694 |
| 31827 | 1717 |
| 31828 | 1682 |
| 31829 | 1660 |
| 31830 | 1606 |
| 31831 | 1556 |
| 31832 | 1513 |
| 31833 | 1515 |
| 31834 | 1529 |
| 31835 | 1516 |
| 31836 | 1511 |
| 31837 | 1514 |
| 31838 | 1511 |
| 31839 | 1526 |
| 31840 | 1538 |
| 31841 | 1535 |
| 31842 | 1553 |
| 31843 | 1580 |
| 31844 | 1618 |
| 31845 | 1663 |
| 31846 | 1753 |
| 31847 | 1875 |
| 31848 | 1975 |
| 31849 | 2034 |
| 31850 | 2064 |
| 31851 | 2081 |
| 31852 | 2082 |
| 31853 | 2073 |
| 31854 | 2060 |
| 31855 | 2034 |
| 31856 | 1999 |
| 31857 | 1977 |
| 31858 | 1962 |
| 31859 | 1928 |
| 31860 | 1900 |
| 31861 | 1830 |
| 31862 | 1769 |
| 31863 | 1710 |
| 31864 | 1688 |
| 31865 | 1659 |
| 31866 | 1667 |
| 31867 | 1669 |
| 31868 | 1594 |
| 31869 | 1531 |
| 31870 | 1449 |
| 31871 | 1383 |
| 31872 | 1306 |
| 31873 | 1248 |
| 31874 | 1185 |
| 31875 | 1120 |
| 31876 | 1141 |
| 31877 | 1145 |
| 31878 | 1098 |
| 31879 | 1070 |
| 31880 | 1039 |
| 31881 | 1011 |
| 31882 | 981 |
| 31883 | 950 |
| 31884 | 934 |
| 31885 | 914 |
| 31886 | 911 |
| 31887 | 904 |
| 31888 | 903 |
| 31889 | 908 |
| 31890 | 911 |
| 31891 | 912 |
| 31892 | 936 |
| 31893 | 940 |
| 31894 | 966 |
| 31895 | 994 |
| 31896 | 1062 |
| 31897 | 1088 |
| 31898 | 1142 |
| 31899 | 1195 |
| 31900 | 1320 |
| 31901 | 1415 |
| 31902 | 1507 |
| 31903 | 1569 |
| 31904 | 1688 |
| 31905 | 1750 |
| 31906 | 1803 |
| 31907 | 1838 |
| 31908 | 1855 |
| 31909 | 1869 |
| 31910 | 1872 |
| 31911 | 1889 |
| 31912 | 1866 |
| 31913 | 1855 |
| 31914 | 1853 |
| 31915 | 1859 |
| 31916 | 1858 |
| 31917 | 1853 |
| 31918 | 1841 |
| 31919 | 1839 |
| 31920 | 1856 |
| 31921 | 1878 |
| 31922 | 1904 |
| 31923 | 1914 |
| 31924 | 1883 |
| 31925 | 1877 |
| 31926 | 1876 |
| 31927 | 1849 |
| 31928 | 1803 |
| 31929 | 1828 |
| 31930 | 1871 |
| 31931 | 1838 |
| 31932 | 1835 |
| 31933 | 1831 |
| 31934 | 1832 |
| 31935 | 1844 |
| 31936 | 1859 |
| 31937 | 1870 |
| 31938 | 1884 |
| 31939 | 1906 |
| 31940 | 1957 |
| 31941 | 2020 |
| 31942 | 2084 |
| 31943 | 2194 |
| 31944 | 2288 |
| 31945 | 2354 |
| 31946 | 2397 |
| 31947 | 2419 |
| 31948 | 2398 |
| 31949 | 2383 |
| 31950 | 2384 |
| 31951 | 2367 |
| 31952 | 2335 |
| 31953 | 2295 |
| 31954 | 2255 |
| 31955 | 2217 |
| 31956 | 2178 |
| 31957 | 2088 |
| 31958 | 2018 |
| 31959 | 1952 |
| 31960 | 1929 |
| 31961 | 1877 |
| 31962 | 1891 |
| 31963 | 1861 |
| 31964 | 1778 |
| 31965 | 1702 |
| 31966 | 1609 |
| 31967 | 1512 |
| 31968 | 1418 |
| 31969 | 1350 |
| 31970 | 1282 |
| 31971 | 1230 |
| 31972 | 1263 |
| 31973 | 1281 |
| 31974 | 1239 |
| 31975 | 1202 |
| 31976 | 1174 |
| 31977 | 1146 |
| 31978 | 1123 |
| 31979 | 1097 |
| 31980 | 1079 |
| 31981 | 1062 |
| 31982 | 1049 |
| 31983 | 1043 |
| 31984 | 1040 |
| 31985 | 1033 |
| 31986 | 1037 |
| 31987 | 1038 |
| 31988 | 1055 |
| 31989 | 1063 |
| 31990 | 1078 |
| 31991 | 1103 |
| 31992 | 1144 |
| 31993 | 1162 |
| 31994 | 1217 |
| 31995 | 1259 |
| 31996 | 1400 |
| 31997 | 1491 |
| 31998 | 1573 |
| 31999 | 1646 |
| 32000 | 1743 |
| 32001 | 1802 |
| 32002 | 1843 |
| 32003 | 1881 |
| 32004 | 1903 |
| 32005 | 1904 |
| 32006 | 1902 |
| 32007 | 1891 |
| 32008 | 1842 |
| 32009 | 1803 |
| 32010 | 1776 |
| 32011 | 1762 |
| 32012 | 1749 |
| 32013 | 1761 |
| 32014 | 1761 |
| 32015 | 1770 |
| 32016 | 1782 |
| 32017 | 1787 |
| 32018 | 1809 |
| 32019 | 1828 |
| 32020 | 1803 |
| 32021 | 1788 |
| 32022 | 1770 |
| 32023 | 1755 |
| 32024 | 1746 |
| 32025 | 1769 |
| 32026 | 1809 |
| 32027 | 1804 |
| 32028 | 1822 |
| 32029 | 1839 |
| 32030 | 1844 |
| 32031 | 1857 |
| 32032 | 1896 |
| 32033 | 1929 |
| 32034 | 1947 |
| 32035 | 1982 |
| 32036 | 2021 |
| 32037 | 2057 |
| 32038 | 2129 |
| 32039 | 2236 |
| 32040 | 2324 |
| 32041 | 2369 |
| 32042 | 2405 |
| 32043 | 2427 |
| 32044 | 2417 |
| 32045 | 2411 |
| 32046 | 2399 |
| 32047 | 2385 |
| 32048 | 2361 |
| 32049 | 2312 |
| 32050 | 2266 |
| 32051 | 2222 |
| 32052 | 2166 |
| 32053 | 2084 |
| 32054 | 2021 |
| 32055 | 1951 |
| 32056 | 1919 |
| 32057 | 1873 |
| 32058 | 1892 |
| 32059 | 1854 |
| 32060 | 1754 |
| 32061 | 1686 |
| 32062 | 1609 |
| 32063 | 1524 |
| 32064 | 1435 |
| 32065 | 1359 |
| 32066 | 1296 |
| 32067 | 1236 |
| 32068 | 1268 |
| 32069 | 1277 |
| 32070 | 1231 |
| 32071 | 1197 |
| 32072 | 1172 |
| 32073 | 1137 |
| 32074 | 1115 |
| 32075 | 1093 |
| 32076 | 1081 |
| 32077 | 1064 |
| 32078 | 1045 |
| 32079 | 1027 |
| 32080 | 1018 |
| 32081 | 1007 |
| 32082 | 1006 |
| 32083 | 1003 |
| 32084 | 1038 |
| 32085 | 1044 |
| 32086 | 1056 |
| 32087 | 1078 |
| 32088 | 1123 |
| 32089 | 1132 |
| 32090 | 1182 |
| 32091 | 1228 |
| 32092 | 1364 |
| 32093 | 1463 |
| 32094 | 1544 |
| 32095 | 1614 |
| 32096 | 1707 |
| 32097 | 1771 |
| 32098 | 1809 |
| 32099 | 1826 |
| 32100 | 1828 |
| 32101 | 1843 |
| 32102 | 1856 |
| 32103 | 1863 |
| 32104 | 1847 |
| 32105 | 1834 |
| 32106 | 1841 |
| 32107 | 1844 |
| 32108 | 1860 |
| 32109 | 1851 |
| 32110 | 1852 |
| 32111 | 1860 |
| 32112 | 1852 |
| 32113 | 1859 |
| 32114 | 1882 |
| 32115 | 1889 |
| 32116 | 1846 |
| 32117 | 1803 |
| 32118 | 1768 |
| 32119 | 1755 |
| 32120 | 1754 |
| 32121 | 1815 |
| 32122 | 1845 |
| 32123 | 1866 |
| 32124 | 1881 |
| 32125 | 1897 |
| 32126 | 1900 |
| 32127 | 1900 |
| 32128 | 1915 |
| 32129 | 1932 |
| 32130 | 1949 |
| 32131 | 1963 |
| 32132 | 2003 |
| 32133 | 2051 |
| 32134 | 2111 |
| 32135 | 2228 |
| 32136 | 2313 |
| 32137 | 2357 |
| 32138 | 2413 |
| 32139 | 2424 |
| 32140 | 2410 |
| 32141 | 2408 |
| 32142 | 2391 |
| 32143 | 2362 |
| 32144 | 2331 |
| 32145 | 2286 |
| 32146 | 2240 |
| 32147 | 2185 |
| 32148 | 2137 |
| 32149 | 2073 |
| 32150 | 2006 |
| 32151 | 1944 |
| 32152 | 1902 |
| 32153 | 1856 |
| 32154 | 1874 |
| 32155 | 1849 |
| 32156 | 1754 |
| 32157 | 1671 |
| 32158 | 1585 |
| 32159 | 1506 |
| 32160 | 1414 |
| 32161 | 1335 |
| 32162 | 1268 |
| 32163 | 1205 |
| 32164 | 1239 |
| 32165 | 1254 |
| 32166 | 1217 |
| 32167 | 1173 |
| 32168 | 1151 |
| 32169 | 1120 |
| 32170 | 1086 |
| 32171 | 1057 |
| 32172 | 1043 |
| 32173 | 1025 |
| 32174 | 1014 |
| 32175 | 996 |
| 32176 | 984 |
| 32177 | 971 |
| 32178 | 968 |
| 32179 | 981 |
| 32180 | 1001 |
| 32181 | 1010 |
| 32182 | 1028 |
| 32183 | 1049 |
| 32184 | 1101 |
| 32185 | 1119 |
| 32186 | 1165 |
| 32187 | 1212 |
| 32188 | 1347 |
| 32189 | 1442 |
| 32190 | 1526 |
| 32191 | 1616 |
| 32192 | 1702 |
| 32193 | 1762 |
| 32194 | 1809 |
| 32195 | 1842 |
| 32196 | 1863 |
| 32197 | 1848 |
| 32198 | 1860 |
| 32199 | 1866 |
| 32200 | 1850 |
| 32201 | 1855 |
| 32202 | 1864 |
| 32203 | 1862 |
| 32204 | 1867 |
| 32205 | 1878 |
| 32206 | 1890 |
| 32207 | 1910 |
| 32208 | 1929 |
| 32209 | 1950 |
| 32210 | 1967 |
| 32211 | 1963 |
| 32212 | 1946 |
| 32213 | 1931 |
| 32214 | 1927 |
| 32215 | 1912 |
| 32216 | 1894 |
| 32217 | 1898 |
| 32218 | 1914 |
| 32219 | 1899 |
| 32220 | 1901 |
| 32221 | 1911 |
| 32222 | 1924 |
| 32223 | 1920 |
| 32224 | 1936 |
| 32225 | 1950 |
| 32226 | 1961 |
| 32227 | 1963 |
| 32228 | 2004 |
| 32229 | 2049 |
| 32230 | 2116 |
| 32231 | 2211 |
| 32232 | 2281 |
| 32233 | 2326 |
| 32234 | 2361 |
| 32235 | 2387 |
| 32236 | 2359 |
| 32237 | 2355 |
| 32238 | 2342 |
| 32239 | 2347 |
| 32240 | 2307 |
| 32241 | 2262 |
| 32242 | 2210 |
| 32243 | 2174 |
| 32244 | 2125 |
| 32245 | 2053 |
| 32246 | 1982 |
| 32247 | 1928 |
| 32248 | 1900 |
| 32249 | 1859 |
| 32250 | 1866 |
| 32251 | 1836 |
| 32252 | 1745 |
| 32253 | 1648 |
| 32254 | 1572 |
| 32255 | 1482 |
| 32256 | 1407 |
| 32257 | 1336 |
| 32258 | 1270 |
| 32259 | 1209 |
| 32260 | 1242 |
| 32261 | 1236 |
| 32262 | 1191 |
| 32263 | 1150 |
| 32264 | 1113 |
| 32265 | 1086 |
| 32266 | 1058 |
| 32267 | 1033 |
| 32268 | 1010 |
| 32269 | 992 |
| 32270 | 976 |
| 32271 | 968 |
| 32272 | 964 |
| 32273 | 961 |
| 32274 | 958 |
| 32275 | 961 |
| 32276 | 983 |
| 32277 | 985 |
| 32278 | 998 |
| 32279 | 1022 |
| 32280 | 1067 |
| 32281 | 1098 |
| 32282 | 1138 |
| 32283 | 1186 |
| 32284 | 1314 |
| 32285 | 1412 |
| 32286 | 1487 |
| 32287 | 1562 |
| 32288 | 1662 |
| 32289 | 1727 |
| 32290 | 1781 |
| 32291 | 1817 |
| 32292 | 1850 |
| 32293 | 1866 |
| 32294 | 1871 |
| 32295 | 1887 |
| 32296 | 1863 |
| 32297 | 1865 |
| 32298 | 1877 |
| 32299 | 1887 |
| 32300 | 1906 |
| 32301 | 1903 |
| 32302 | 1911 |
| 32303 | 1927 |
| 32304 | 1952 |
| 32305 | 1976 |
| 32306 | 2009 |
| 32307 | 2007 |
| 32308 | 1990 |
| 32309 | 1973 |
| 32310 | 1948 |
| 32311 | 1924 |
| 32312 | 1907 |
| 32313 | 1917 |
| 32314 | 1941 |
| 32315 | 1908 |
| 32316 | 1908 |
| 32317 | 1904 |
| 32318 | 1892 |
| 32319 | 1888 |
| 32320 | 1910 |
| 32321 | 1918 |
| 32322 | 1919 |
| 32323 | 1929 |
| 32324 | 1967 |
| 32325 | 2040 |
| 32326 | 2109 |
| 32327 | 2188 |
| 32328 | 2253 |
| 32329 | 2283 |
| 32330 | 2302 |
| 32331 | 2308 |
| 32332 | 2282 |
| 32333 | 2259 |
| 32334 | 2238 |
| 32335 | 2221 |
| 32336 | 2187 |
| 32337 | 2140 |
| 32338 | 2102 |
| 32339 | 2056 |
| 32340 | 2020 |
| 32341 | 1952 |
| 32342 | 1896 |
| 32343 | 1850 |
| 32344 | 1838 |
| 32345 | 1820 |
| 32346 | 1838 |
| 32347 | 1812 |
| 32348 | 1737 |
| 32349 | 1673 |
| 32350 | 1615 |
| 32351 | 1540 |
| 32352 | 1465 |
| 32353 | 1390 |
| 32354 | 1328 |
| 32355 | 1270 |
| 32356 | 1292 |
| 32357 | 1298 |
| 32358 | 1248 |
| 32359 | 1198 |
| 32360 | 1163 |
| 32361 | 1132 |
| 32362 | 1093 |
| 32363 | 1064 |
| 32364 | 1040 |
| 32365 | 1030 |
| 32366 | 1023 |
| 32367 | 1006 |
| 32368 | 1001 |
| 32369 | 985 |
| 32370 | 980 |
| 32371 | 982 |
| 32372 | 995 |
| 32373 | 998 |
| 32374 | 999 |
| 32375 | 998 |
| 32376 | 1011 |
| 32377 | 1012 |
| 32378 | 1019 |
| 32379 | 1026 |
| 32380 | 1096 |
| 32381 | 1137 |
| 32382 | 1188 |
| 32383 | 1237 |
| 32384 | 1304 |
| 32385 | 1367 |
| 32386 | 1437 |
| 32387 | 1493 |
| 32388 | 1546 |
| 32389 | 1608 |
| 32390 | 1655 |
| 32391 | 1708 |
| 32392 | 1750 |
| 32393 | 1796 |
| 32394 | 1830 |
| 32395 | 1861 |
| 32396 | 1881 |
| 32397 | 1921 |
| 32398 | 1947 |
| 32399 | 1967 |
| 32400 | 1994 |
| 32401 | 2014 |
| 32402 | 2034 |
| 32403 | 2036 |
| 32404 | 2024 |
| 32405 | 2018 |
| 32406 | 1992 |
| 32407 | 1963 |
| 32408 | 1952 |
| 32409 | 1933 |
| 32410 | 1950 |
| 32411 | 1940 |
| 32412 | 1927 |
| 32413 | 1908 |
| 32414 | 1906 |
| 32415 | 1887 |
| 32416 | 1884 |
| 32417 | 1887 |
| 32418 | 1891 |
| 32419 | 1906 |
| 32420 | 1937 |
| 32421 | 1994 |
| 32422 | 2066 |
| 32423 | 2150 |
| 32424 | 2204 |
| 32425 | 2235 |
| 32426 | 2251 |
| 32427 | 2252 |
| 32428 | 2243 |
| 32429 | 2224 |
| 32430 | 2203 |
| 32431 | 2169 |
| 32432 | 2127 |
| 32433 | 2089 |
| 32434 | 2047 |
| 32435 | 2010 |
| 32436 | 1970 |
| 32437 | 1914 |
| 32438 | 1856 |
| 32439 | 1808 |
| 32440 | 1808 |
| 32441 | 1789 |
| 32442 | 1823 |
| 32443 | 1820 |
| 32444 | 1756 |
| 32445 | 1706 |
| 32446 | 1656 |
| 32447 | 1597 |
| 32448 | 1522 |
| 32449 | 1461 |
| 32450 | 1398 |
| 32451 | 1332 |
| 32452 | 1358 |
| 32453 | 1355 |
| 32454 | 1303 |
| 32455 | 1256 |
| 32456 | 1214 |
| 32457 | 1172 |
| 32458 | 1131 |
| 32459 | 1093 |
| 32460 | 1069 |
| 32461 | 1049 |
| 32462 | 1030 |
| 32463 | 1007 |
| 32464 | 1001 |
| 32465 | 991 |
| 32466 | 984 |
| 32467 | 981 |
| 32468 | 987 |
| 32469 | 986 |
| 32470 | 979 |
| 32471 | 979 |
| 32472 | 983 |
| 32473 | 973 |
| 32474 | 973 |
| 32475 | 948 |
| 32476 | 978 |
| 32477 | 989 |
| 32478 | 1019 |
| 32479 | 1043 |
| 32480 | 1095 |
| 32481 | 1143 |
| 32482 | 1188 |
| 32483 | 1228 |
| 32484 | 1275 |
| 32485 | 1330 |
| 32486 | 1388 |
| 32487 | 1446 |
| 32488 | 1500 |
| 32489 | 1545 |
| 32490 | 1587 |
| 32491 | 1643 |
| 32492 | 1682 |
| 32493 | 1711 |
| 32494 | 1733 |
| 32495 | 1743 |
| 32496 | 1773 |
| 32497 | 1841 |
| 32498 | 1911 |
| 32499 | 1951 |
| 32500 | 1922 |
| 32501 | 1894 |
| 32502 | 1839 |
| 32503 | 1790 |
| 32504 | 1736 |
| 32505 | 1719 |
| 32506 | 1742 |
| 32507 | 1723 |
| 32508 | 1708 |
| 32509 | 1697 |
| 32510 | 1686 |
| 32511 | 1678 |
| 32512 | 1666 |
| 32513 | 1651 |
| 32514 | 1649 |
| 32515 | 1658 |
| 32516 | 1687 |
| 32517 | 1724 |
| 32518 | 1828 |
| 32519 | 1932 |
| 32520 | 2001 |
| 32521 | 2047 |
| 32522 | 2072 |
| 32523 | 2089 |
| 32524 | 2098 |
| 32525 | 2099 |
| 32526 | 2087 |
| 32527 | 2075 |
| 32528 | 2046 |
| 32529 | 2021 |
| 32530 | 2010 |
| 32531 | 1975 |
| 32532 | 1947 |
| 32533 | 1888 |
| 32534 | 1818 |
| 32535 | 1758 |
| 32536 | 1744 |
| 32537 | 1718 |
| 32538 | 1735 |
| 32539 | 1741 |
| 32540 | 1662 |
| 32541 | 1598 |
| 32542 | 1512 |
| 32543 | 1447 |
| 32544 | 1362 |
| 32545 | 1302 |
| 32546 | 1235 |
| 32547 | 1168 |
| 32548 | 1195 |
| 32549 | 1194 |
| 32550 | 1145 |
| 32551 | 1110 |
| 32552 | 1081 |
| 32553 | 1050 |
| 32554 | 1016 |
| 32555 | 982 |
| 32556 | 964 |
| 32557 | 944 |
| 32558 | 940 |
| 32559 | 928 |
| 32560 | 923 |
| 32561 | 923 |
| 32562 | 919 |
| 32563 | 927 |
| 32564 | 943 |
| 32565 | 949 |
| 32566 | 967 |
| 32567 | 1001 |
| 32568 | 1062 |
| 32569 | 1085 |
| 32570 | 1137 |
| 32571 | 1182 |
| 32572 | 1310 |
| 32573 | 1402 |
| 32574 | 1498 |
| 32575 | 1561 |
| 32576 | 1678 |
| 32577 | 1741 |
| 32578 | 1794 |
| 32579 | 1834 |
| 32580 | 1843 |
| 32581 | 1855 |
| 32582 | 1849 |
| 32583 | 1854 |
| 32584 | 1830 |
| 32585 | 1811 |
| 32586 | 1794 |
| 32587 | 1773 |
| 32588 | 1787 |
| 32589 | 1793 |
| 32590 | 1791 |
| 32591 | 1801 |
| 32592 | 1819 |
| 32593 | 1840 |
| 32594 | 1863 |
| 32595 | 1884 |
| 32596 | 1858 |
| 32597 | 1837 |
| 32598 | 1841 |
| 32599 | 1838 |
| 32600 | 1825 |
| 32601 | 1878 |
| 32602 | 1926 |
| 32603 | 1890 |
| 32604 | 1883 |
| 32605 | 1878 |
| 32606 | 1879 |
| 32607 | 1887 |
| 32608 | 1905 |
| 32609 | 1917 |
| 32610 | 1927 |
| 32611 | 1941 |
| 32612 | 2005 |
| 32613 | 2072 |
| 32614 | 2155 |
| 32615 | 2242 |
| 32616 | 2317 |
| 32617 | 2368 |
| 32618 | 2402 |
| 32619 | 2427 |
| 32620 | 2408 |
| 32621 | 2398 |
| 32622 | 2385 |
| 32623 | 2369 |
| 32624 | 2341 |
| 32625 | 2297 |
| 32626 | 2264 |
| 32627 | 2228 |
| 32628 | 2185 |
| 32629 | 2101 |
| 32630 | 2029 |
| 32631 | 1967 |
| 32632 | 1944 |
| 32633 | 1892 |
| 32634 | 1906 |
| 32635 | 1882 |
| 32636 | 1798 |
| 32637 | 1716 |
| 32638 | 1620 |
| 32639 | 1532 |
| 32640 | 1437 |
| 32641 | 1369 |
| 32642 | 1300 |
| 32643 | 1243 |
| 32644 | 1274 |
| 32645 | 1286 |
| 32646 | 1242 |
| 32647 | 1202 |
| 32648 | 1172 |
| 32649 | 1138 |
| 32650 | 1109 |
| 32651 | 1082 |
| 32652 | 1058 |
| 32653 | 1044 |
| 32654 | 1034 |
| 32655 | 1026 |
| 32656 | 1024 |
| 32657 | 1015 |
| 32658 | 1018 |
| 32659 | 1021 |
| 32660 | 1037 |
| 32661 | 1042 |
| 32662 | 1058 |
| 32663 | 1086 |
| 32664 | 1134 |
| 32665 | 1157 |
| 32666 | 1202 |
| 32667 | 1244 |
| 32668 | 1384 |
| 32669 | 1470 |
| 32670 | 1546 |
| 32671 | 1622 |
| 32672 | 1724 |
| 32673 | 1783 |
| 32674 | 1837 |
| 32675 | 1889 |
| 32676 | 1917 |
| 32677 | 1914 |
| 32678 | 1914 |
| 32679 | 1920 |
| 32680 | 1905 |
| 32681 | 1895 |
| 32682 | 1898 |
| 32683 | 1898 |
| 32684 | 1900 |
| 32685 | 1914 |
| 32686 | 1929 |
| 32687 | 1956 |
| 32688 | 1974 |
| 32689 | 2000 |
| 32690 | 2027 |
| 32691 | 2039 |
| 32692 | 2020 |
| 32693 | 1999 |
| 32694 | 1975 |
| 32695 | 1955 |
| 32696 | 1937 |
| 32697 | 1953 |
| 32698 | 2000 |
| 32699 | 1997 |
| 32700 | 1997 |
| 32701 | 2000 |
| 32702 | 1985 |
| 32703 | 1986 |
| 32704 | 1999 |
| 32705 | 2015 |
| 32706 | 2028 |
| 32707 | 2038 |
| 32708 | 2071 |
| 32709 | 2108 |
| 32710 | 2173 |
| 32711 | 2273 |
| 32712 | 2350 |
| 32713 | 2388 |
| 32714 | 2423 |
| 32715 | 2441 |
| 32716 | 2429 |
| 32717 | 2415 |
| 32718 | 2409 |
| 32719 | 2403 |
| 32720 | 2377 |
| 32721 | 2328 |
| 32722 | 2278 |
| 32723 | 2238 |
| 32724 | 2187 |
| 32725 | 2108 |
| 32726 | 2046 |
| 32727 | 1981 |
| 32728 | 1951 |
| 32729 | 1910 |
| 32730 | 1927 |
| 32731 | 1890 |
| 32732 | 1785 |
| 32733 | 1712 |
| 32734 | 1636 |
| 32735 | 1548 |
| 32736 | 1458 |
| 32737 | 1381 |
| 32738 | 1314 |
| 32739 | 1252 |
| 32740 | 1290 |
| 32741 | 1299 |
| 32742 | 1252 |
| 32743 | 1217 |
| 32744 | 1186 |
| 32745 | 1150 |
| 32746 | 1122 |
| 32747 | 1094 |
| 32748 | 1075 |
| 32749 | 1059 |
| 32750 | 1041 |
| 32751 | 1021 |
| 32752 | 1014 |
| 32753 | 1006 |
| 32754 | 1009 |
| 32755 | 1005 |
| 32756 | 1038 |
| 32757 | 1045 |
| 32758 | 1062 |
| 32759 | 1072 |
| 32760 | 1117 |
| 32761 | 1129 |
| 32762 | 1176 |
| 32763 | 1225 |
| 32764 | 1361 |
| 32765 | 1463 |
| 32766 | 1545 |
| 32767 | 1611 |
| 32768 | 1697 |
| 32769 | 1764 |
| 32770 | 1819 |
| 32771 | 1856 |
| 32772 | 1866 |
| 32773 | 1874 |
| 32774 | 1890 |
| 32775 | 1909 |
| 32776 | 1885 |
| 32777 | 1872 |
| 32778 | 1872 |
| 32779 | 1881 |
| 32780 | 1887 |
| 32781 | 1892 |
| 32782 | 1910 |
| 32783 | 1926 |
| 32784 | 1938 |
| 32785 | 1985 |
| 32786 | 2019 |
| 32787 | 2034 |
| 32788 | 2004 |
| 32789 | 1979 |
| 32790 | 1956 |
| 32791 | 1935 |
| 32792 | 1929 |
| 32793 | 1952 |
| 32794 | 1977 |
| 32795 | 1965 |
| 32796 | 1968 |
| 32797 | 1974 |
| 32798 | 1965 |
| 32799 | 1940 |
| 32800 | 1963 |
| 32801 | 1977 |
| 32802 | 1992 |
| 32803 | 1998 |
| 32804 | 2035 |
| 32805 | 2090 |
| 32806 | 2156 |
| 32807 | 2234 |
| 32808 | 2301 |
| 32809 | 2342 |
| 32810 | 2386 |
| 32811 | 2404 |
| 32812 | 2394 |
| 32813 | 2387 |
| 32814 | 2369 |
| 32815 | 2343 |
| 32816 | 2313 |
| 32817 | 2269 |
| 32818 | 2225 |
| 32819 | 2172 |
| 32820 | 2131 |
| 32821 | 2059 |
| 32822 | 2000 |
| 32823 | 1935 |
| 32824 | 1897 |
| 32825 | 1850 |
| 32826 | 1867 |
| 32827 | 1855 |
| 32828 | 1764 |
| 32829 | 1681 |
| 32830 | 1589 |
| 32831 | 1502 |
| 32832 | 1415 |
| 32833 | 1333 |
| 32834 | 1257 |
| 32835 | 1189 |
| 32836 | 1220 |
| 32837 | 1240 |
| 32838 | 1199 |
| 32839 | 1154 |
| 32840 | 1127 |
| 32841 | 1098 |
| 32842 | 1060 |
| 32843 | 1032 |
| 32844 | 1017 |
| 32845 | 1000 |
| 32846 | 986 |
| 32847 | 967 |
| 32848 | 956 |
| 32849 | 946 |
| 32850 | 942 |
| 32851 | 953 |
| 32852 | 969 |
| 32853 | 978 |
| 32854 | 999 |
| 32855 | 1029 |
| 32856 | 1075 |
| 32857 | 1094 |
| 32858 | 1138 |
| 32859 | 1184 |
| 32860 | 1319 |
| 32861 | 1409 |
| 32862 | 1494 |
| 32863 | 1574 |
| 32864 | 1655 |
| 32865 | 1720 |
| 32866 | 1772 |
| 32867 | 1827 |
| 32868 | 1855 |
| 32869 | 1842 |
| 32870 | 1865 |
| 32871 | 1878 |
| 32872 | 1864 |
| 32873 | 1863 |
| 32874 | 1864 |
| 32875 | 1872 |
| 32876 | 1891 |
| 32877 | 1898 |
| 32878 | 1908 |
| 32879 | 1931 |
| 32880 | 1945 |
| 32881 | 1957 |
| 32882 | 2001 |
| 32883 | 2022 |
| 32884 | 2009 |
| 32885 | 1982 |
| 32886 | 1961 |
| 32887 | 1949 |
| 32888 | 1942 |
| 32889 | 1957 |
| 32890 | 1980 |
| 32891 | 1953 |
| 32892 | 1951 |
| 32893 | 1948 |
| 32894 | 1948 |
| 32895 | 1943 |
| 32896 | 1952 |
| 32897 | 1957 |
| 32898 | 1958 |
| 32899 | 1962 |
| 32900 | 1993 |
| 32901 | 2036 |
| 32902 | 2124 |
| 32903 | 2197 |
| 32904 | 2255 |
| 32905 | 2291 |
| 32906 | 2326 |
| 32907 | 2347 |
| 32908 | 2319 |
| 32909 | 2309 |
| 32910 | 2301 |
| 32911 | 2304 |
| 32912 | 2272 |
| 32913 | 2224 |
| 32914 | 2169 |
| 32915 | 2133 |
| 32916 | 2083 |
| 32917 | 2006 |
| 32918 | 1935 |
| 32919 | 1878 |
| 32920 | 1851 |
| 32921 | 1811 |
| 32922 | 1833 |
| 32923 | 1804 |
| 32924 | 1719 |
| 32925 | 1631 |
| 32926 | 1551 |
| 32927 | 1461 |
| 32928 | 1379 |
| 32929 | 1301 |
| 32930 | 1234 |
| 32931 | 1169 |
| 32932 | 1196 |
| 32933 | 1193 |
| 32934 | 1143 |
| 32935 | 1103 |
| 32936 | 1067 |
| 32937 | 1039 |
| 32938 | 1010 |
| 32939 | 985 |
| 32940 | 959 |
| 32941 | 941 |
| 32942 | 923 |
| 32943 | 913 |
| 32944 | 915 |
| 32945 | 912 |
| 32946 | 907 |
| 32947 | 915 |
| 32948 | 940 |
| 32949 | 946 |
| 32950 | 963 |
| 32951 | 986 |
| 32952 | 1027 |
| 32953 | 1044 |
| 32954 | 1088 |
| 32955 | 1137 |
| 32956 | 1265 |
| 32957 | 1358 |
| 32958 | 1436 |
| 32959 | 1514 |
| 32960 | 1605 |
| 32961 | 1662 |
| 32962 | 1717 |
| 32963 | 1780 |
| 32964 | 1816 |
| 32965 | 1819 |
| 32966 | 1833 |
| 32967 | 1836 |
| 32968 | 1811 |
| 32969 | 1808 |
| 32970 | 1820 |
| 32971 | 1830 |
| 32972 | 1875 |
| 32973 | 1876 |
| 32974 | 1877 |
| 32975 | 1895 |
| 32976 | 1906 |
| 32977 | 1942 |
| 32978 | 1985 |
| 32979 | 1989 |
| 32980 | 1973 |
| 32981 | 1957 |
| 32982 | 1919 |
| 32983 | 1901 |
| 32984 | 1886 |
| 32985 | 1896 |
| 32986 | 1921 |
| 32987 | 1895 |
| 32988 | 1894 |
| 32989 | 1891 |
| 32990 | 1876 |
| 32991 | 1861 |
| 32992 | 1865 |
| 32993 | 1872 |
| 32994 | 1869 |
| 32995 | 1892 |
| 32996 | 1932 |
| 32997 | 2011 |
| 32998 | 2089 |
| 32999 | 2148 |
| 33000 | 2210 |
| 33001 | 2259 |
| 33002 | 2286 |
| 33003 | 2298 |
| 33004 | 2274 |
| 33005 | 2251 |
| 33006 | 2224 |
| 33007 | 2204 |
| 33008 | 2165 |
| 33009 | 2123 |
| 33010 | 2082 |
| 33011 | 2040 |
| 33012 | 2002 |
| 33013 | 1925 |
| 33014 | 1867 |
| 33015 | 1825 |
| 33016 | 1821 |
| 33017 | 1800 |
| 33018 | 1825 |
| 33019 | 1800 |
| 33020 | 1724 |
| 33021 | 1661 |
| 33022 | 1595 |
| 33023 | 1514 |
| 33024 | 1445 |
| 33025 | 1360 |
| 33026 | 1288 |
| 33027 | 1236 |
| 33028 | 1269 |
| 33029 | 1272 |
| 33030 | 1221 |
| 33031 | 1172 |
| 33032 | 1132 |
| 33033 | 1097 |
| 33034 | 1065 |
| 33035 | 1038 |
| 33036 | 1014 |
| 33037 | 1006 |
| 33038 | 997 |
| 33039 | 973 |
| 33040 | 962 |
| 33041 | 950 |
| 33042 | 948 |
| 33043 | 947 |
| 33044 | 961 |
| 33045 | 966 |
| 33046 | 968 |
| 33047 | 963 |
| 33048 | 982 |
| 33049 | 988 |
| 33050 | 998 |
| 33051 | 1001 |
| 33052 | 1076 |
| 33053 | 1117 |
| 33054 | 1162 |
| 33055 | 1206 |
| 33056 | 1268 |
| 33057 | 1328 |
| 33058 | 1396 |
| 33059 | 1454 |
| 33060 | 1497 |
| 33061 | 1554 |
| 33062 | 1603 |
| 33063 | 1639 |
| 33064 | 1677 |
| 33065 | 1696 |
| 33066 | 1720 |
| 33067 | 1756 |
| 33068 | 1772 |
| 33069 | 1805 |
| 33070 | 1842 |
| 33071 | 1861 |
| 33072 | 1880 |
| 33073 | 1893 |
| 33074 | 1940 |
| 33075 | 1988 |
| 33076 | 1982 |
| 33077 | 1971 |
| 33078 | 1949 |
| 33079 | 1929 |
| 33080 | 1913 |
| 33081 | 1907 |
| 33082 | 1929 |
| 33083 | 1914 |
| 33084 | 1899 |
| 33085 | 1878 |
| 33086 | 1861 |
| 33087 | 1841 |
| 33088 | 1835 |
| 33089 | 1849 |
| 33090 | 1869 |
| 33091 | 1896 |
| 33092 | 1930 |
| 33093 | 1986 |
| 33094 | 2065 |
| 33095 | 2136 |
| 33096 | 2192 |
| 33097 | 2227 |
| 33098 | 2251 |
| 33099 | 2255 |
| 33100 | 2245 |
| 33101 | 2211 |
| 33102 | 2191 |
| 33103 | 2156 |
| 33104 | 2112 |
| 33105 | 2077 |
| 33106 | 2034 |
| 33107 | 1998 |
| 33108 | 1957 |
| 33109 | 1905 |
| 33110 | 1854 |
| 33111 | 1795 |
| 33112 | 1792 |
| 33113 | 1772 |
| 33114 | 1816 |
| 33115 | 1818 |
| 33116 | 1751 |
| 33117 | 1707 |
| 33118 | 1652 |
| 33119 | 1593 |
| 33120 | 1519 |
| 33121 | 1452 |
| 33122 | 1378 |
| 33123 | 1309 |
| 33124 | 1338 |
| 33125 | 1340 |
| 33126 | 1286 |
| 33127 | 1241 |
| 33128 | 1199 |
| 33129 | 1160 |
| 33130 | 1113 |
| 33131 | 1075 |
| 33132 | 1046 |
| 33133 | 1029 |
| 33134 | 1012 |
| 33135 | 993 |
| 33136 | 981 |
| 33137 | 977 |
| 33138 | 959 |
| 33139 | 960 |
| 33140 | 966 |
| 33141 | 961 |
| 33142 | 956 |
| 33143 | 952 |
| 33144 | 961 |
| 33145 | 951 |
| 33146 | 950 |
| 33147 | 927 |
| 33148 | 966 |
| 33149 | 981 |
| 33150 | 1008 |
| 33151 | 1031 |
| 33152 | 1080 |
| 33153 | 1124 |
| 33154 | 1172 |
| 33155 | 1219 |
| 33156 | 1260 |
| 33157 | 1301 |
| 33158 | 1357 |
| 33159 | 1403 |
| 33160 | 1449 |
| 33161 | 1488 |
| 33162 | 1501 |
| 33163 | 1536 |
| 33164 | 1601 |
| 33165 | 1634 |
| 33166 | 1658 |
| 33167 | 1676 |
| 33168 | 1683 |
| 33169 | 1760 |
| 33170 | 1835 |
| 33171 | 1866 |
| 33172 | 1844 |
| 33173 | 1809 |
| 33174 | 1768 |
| 33175 | 1727 |
| 33176 | 1692 |
| 33177 | 1692 |
| 33178 | 1722 |
| 33179 | 1697 |
| 33180 | 1664 |
| 33181 | 1656 |
| 33182 | 1653 |
| 33183 | 1645 |
| 33184 | 1623 |
| 33185 | 1615 |
| 33186 | 1614 |
| 33187 | 1630 |
| 33188 | 1656 |
| 33189 | 1692 |
| 33190 | 1782 |
| 33191 | 1888 |
| 33192 | 1966 |
| 33193 | 2014 |
| 33194 | 2042 |
| 33195 | 2056 |
| 33196 | 2066 |
| 33197 | 2063 |
| 33198 | 2053 |
| 33199 | 2040 |
| 33200 | 2013 |
| 33201 | 1982 |
| 33202 | 1960 |
| 33203 | 1929 |
| 33204 | 1902 |
| 33205 | 1841 |
| 33206 | 1776 |
| 33207 | 1719 |
| 33208 | 1713 |
| 33209 | 1688 |
| 33210 | 1722 |
| 33211 | 1723 |
| 33212 | 1653 |
| 33213 | 1583 |
| 33214 | 1502 |
| 33215 | 1435 |
| 33216 | 1346 |
| 33217 | 1275 |
| 33218 | 1204 |
| 33219 | 1139 |
| 33220 | 1165 |
| 33221 | 1168 |
| 33222 | 1114 |
| 33223 | 1075 |
| 33224 | 1044 |
| 33225 | 1012 |
| 33226 | 978 |
| 33227 | 948 |
| 33228 | 926 |
| 33229 | 903 |
| 33230 | 898 |
| 33231 | 887 |
| 33232 | 881 |
| 33233 | 876 |
| 33234 | 873 |
| 33235 | 883 |
| 33236 | 902 |
| 33237 | 910 |
| 33238 | 922 |
| 33239 | 950 |
| 33240 | 999 |
| 33241 | 1018 |
| 33242 | 1062 |
| 33243 | 1098 |
| 33244 | 1218 |
| 33245 | 1300 |
| 33246 | 1382 |
| 33247 | 1446 |
| 33248 | 1545 |
| 33249 | 1618 |
| 33250 | 1676 |
| 33251 | 1726 |
| 33252 | 1754 |
| 33253 | 1787 |
| 33254 | 1783 |
| 33255 | 1790 |
| 33256 | 1778 |
| 33257 | 1774 |
| 33258 | 1759 |
| 33259 | 1735 |
| 33260 | 1756 |
| 33261 | 1762 |
| 33262 | 1757 |
| 33263 | 1770 |
| 33264 | 1781 |
| 33265 | 1794 |
| 33266 | 1822 |
| 33267 | 1847 |
| 33268 | 1819 |
| 33269 | 1805 |
| 33270 | 1808 |
| 33271 | 1799 |
| 33272 | 1787 |
| 33273 | 1837 |
| 33274 | 1877 |
| 33275 | 1851 |
| 33276 | 1839 |
| 33277 | 1829 |
| 33278 | 1832 |
| 33279 | 1838 |
| 33280 | 1848 |
| 33281 | 1857 |
| 33282 | 1868 |
| 33283 | 1886 |
| 33284 | 1940 |
| 33285 | 2021 |
| 33286 | 2111 |
| 33287 | 2193 |
| 33288 | 2265 |
| 33289 | 2318 |
| 33290 | 2351 |
| 33291 | 2375 |
| 33292 | 2356 |
| 33293 | 2337 |
| 33294 | 2329 |
| 33295 | 2318 |
| 33296 | 2288 |
| 33297 | 2240 |
| 33298 | 2203 |
| 33299 | 2166 |
| 33300 | 2120 |
| 33301 | 2042 |
| 33302 | 1972 |
| 33303 | 1912 |
| 33304 | 1893 |
| 33305 | 1851 |
| 33306 | 1869 |
| 33307 | 1847 |
| 33308 | 1766 |
| 33309 | 1686 |
| 33310 | 1595 |
| 33311 | 1515 |
| 33312 | 1424 |
| 33313 | 1351 |
| 33314 | 1276 |
| 33315 | 1208 |
| 33316 | 1298 |
| 33317 | 1308 |
| 33318 | 1263 |
| 33319 | 1223 |
| 33320 | 1188 |
| 33321 | 1150 |
| 33322 | 1117 |
| 33323 | 1088 |
| 33324 | 1063 |
| 33325 | 1049 |
| 33326 | 1037 |
| 33327 | 1028 |
| 33328 | 1025 |
| 33329 | 1011 |
| 33330 | 1009 |
| 33331 | 1009 |
| 33332 | 1025 |
| 33333 | 1028 |
| 33334 | 1042 |
| 33335 | 1063 |
| 33336 | 1107 |
| 33337 | 1130 |
| 33338 | 1166 |
| 33339 | 1201 |
| 33340 | 1323 |
| 33341 | 1403 |
| 33342 | 1474 |
| 33343 | 1544 |
| 33344 | 1640 |
| 33345 | 1702 |
| 33346 | 1762 |
| 33347 | 1826 |
| 33348 | 1860 |
| 33349 | 1855 |
| 33350 | 1856 |
| 33351 | 1872 |
| 33352 | 1873 |
| 33353 | 1869 |
| 33354 | 1877 |
| 33355 | 1878 |
| 33356 | 1885 |
| 33357 | 1896 |
| 33358 | 1914 |
| 33359 | 1939 |
| 33360 | 1953 |
| 33361 | 1985 |
| 33362 | 2015 |
| 33363 | 2023 |
| 33364 | 2009 |
| 33365 | 1988 |
| 33366 | 1968 |
| 33367 | 1936 |
| 33368 | 1914 |
| 33369 | 1925 |
| 33370 | 1976 |
| 33371 | 1980 |
| 33372 | 1970 |
| 33373 | 1967 |
| 33374 | 1944 |
| 33375 | 1945 |
| 33376 | 1952 |
| 33377 | 1964 |
| 33378 | 1977 |
| 33379 | 1982 |
| 33380 | 2017 |
| 33381 | 2057 |
| 33382 | 2120 |
| 33383 | 2235 |
| 33384 | 2324 |
| 33385 | 2362 |
| 33386 | 2399 |
| 33387 | 2418 |
| 33388 | 2402 |
| 33389 | 2390 |
| 33390 | 2384 |
| 33391 | 2386 |
| 33392 | 2359 |
| 33393 | 2312 |
| 33394 | 2260 |
| 33395 | 2221 |
| 33396 | 2165 |
| 33397 | 2092 |
| 33398 | 2032 |
| 33399 | 1976 |
| 33400 | 1944 |
| 33401 | 1913 |
| 33402 | 1932 |
| 33403 | 1898 |
| 33404 | 1799 |
| 33405 | 1723 |
| 33406 | 1649 |
| 33407 | 1566 |
| 33408 | 1473 |
| 33409 | 1397 |
| 33410 | 1328 |
| 33411 | 1265 |
| 33412 | 1276 |
| 33413 | 1284 |
| 33414 | 1232 |
| 33415 | 1194 |
| 33416 | 1160 |
| 33417 | 1126 |
| 33418 | 1099 |
| 33419 | 1069 |
| 33420 | 1045 |
| 33421 | 1027 |
| 33422 | 1010 |
| 33423 | 992 |
| 33424 | 987 |
| 33425 | 977 |
| 33426 | 982 |
| 33427 | 984 |
| 33428 | 1014 |
| 33429 | 1025 |
| 33430 | 1047 |
| 33431 | 1052 |
| 33432 | 1091 |
| 33433 | 1104 |
| 33434 | 1145 |
| 33435 | 1201 |
| 33436 | 1340 |
| 33437 | 1440 |
| 33438 | 1523 |
| 33439 | 1586 |
| 33440 | 1669 |
| 33441 | 1733 |
| 33442 | 1790 |
| 33443 | 1848 |
| 33444 | 1863 |
| 33445 | 1863 |
| 33446 | 1876 |
| 33447 | 1898 |
| 33448 | 1871 |
| 33449 | 1857 |
| 33450 | 1840 |
| 33451 | 1848 |
| 33452 | 1848 |
| 33453 | 1869 |
| 33454 | 1887 |
| 33455 | 1902 |
| 33456 | 1910 |
| 33457 | 1968 |
| 33458 | 2012 |
| 33459 | 2035 |
| 33460 | 2029 |
| 33461 | 2023 |
| 33462 | 2003 |
| 33463 | 1988 |
| 33464 | 1986 |
| 33465 | 2011 |
| 33466 | 2042 |
| 33467 | 2017 |
| 33468 | 2018 |
| 33469 | 2013 |
| 33470 | 1990 |
| 33471 | 1944 |
| 33472 | 1972 |
| 33473 | 1984 |
| 33474 | 2000 |
| 33475 | 1996 |
| 33476 | 2032 |
| 33477 | 2088 |
| 33478 | 2165 |
| 33479 | 2219 |
| 33480 | 2264 |
| 33481 | 2310 |
| 33482 | 2344 |
| 33483 | 2367 |
| 33484 | 2353 |
| 33485 | 2336 |
| 33486 | 2318 |
| 33487 | 2289 |
| 33488 | 2257 |
| 33489 | 2216 |
| 33490 | 2179 |
| 33491 | 2123 |
| 33492 | 2079 |
| 33493 | 2003 |
| 33494 | 1950 |
| 33495 | 1883 |
| 33496 | 1854 |
| 33497 | 1804 |
| 33498 | 1818 |
| 33499 | 1815 |
| 33500 | 1723 |
| 33501 | 1646 |
| 33502 | 1557 |
| 33503 | 1464 |
| 33504 | 1381 |
| 33505 | 1297 |
| 33506 | 1220 |
| 33507 | 1153 |
| 33508 | 1177 |
| 33509 | 1196 |
| 33510 | 1151 |
| 33511 | 1105 |
| 33512 | 1073 |
| 33513 | 1040 |
| 33514 | 995 |
| 33515 | 969 |
| 33516 | 959 |
| 33517 | 944 |
| 33518 | 928 |
| 33519 | 909 |
| 33520 | 901 |
| 33521 | 894 |
| 33522 | 889 |
| 33523 | 893 |
| 33524 | 913 |
| 33525 | 924 |
| 33526 | 953 |
| 33527 | 992 |
| 33528 | 1033 |
| 33529 | 1051 |
| 33530 | 1090 |
| 33531 | 1138 |
| 33532 | 1278 |
| 33533 | 1364 |
| 33534 | 1446 |
| 33535 | 1518 |
| 33536 | 1593 |
| 33537 | 1647 |
| 33538 | 1698 |
| 33539 | 1760 |
| 33540 | 1803 |
| 33541 | 1787 |
| 33542 | 1813 |
| 33543 | 1832 |
| 33544 | 1815 |
| 33545 | 1808 |
| 33546 | 1799 |
| 33547 | 1805 |
| 33548 | 1820 |
| 33549 | 1827 |
| 33550 | 1837 |
| 33551 | 1862 |
| 33552 | 1876 |
| 33553 | 1873 |
| 33554 | 1922 |
| 33555 | 1943 |
| 33556 | 1932 |
| 33557 | 1906 |
| 33558 | 1868 |
| 33559 | 1856 |
| 33560 | 1859 |
| 33561 | 1880 |
| 33562 | 1912 |
| 33563 | 1883 |
| 33564 | 1886 |
| 33565 | 1884 |
| 33566 | 1885 |
| 33567 | 1882 |
| 33568 | 1882 |
| 33569 | 1886 |
| 33570 | 1877 |
| 33571 | 1884 |
| 33572 | 1914 |
| 33573 | 1967 |
| 33574 | 2075 |
| 33575 | 2130 |
| 33576 | 2184 |
| 33577 | 2213 |
| 33578 | 2252 |
| 33579 | 2270 |
| 33580 | 2245 |
| 33581 | 2228 |
| 33582 | 2216 |
| 33583 | 2212 |
| 33584 | 2182 |
| 33585 | 2136 |
| 33586 | 2072 |
| 33587 | 2041 |
| 33588 | 1991 |
| 33589 | 1911 |
| 33590 | 1848 |
| 33591 | 1791 |
| 33592 | 1765 |
| 33593 | 1721 |
| 33594 | 1746 |
| 33595 | 1715 |
| 33596 | 1642 |
| 33597 | 1552 |
| 33598 | 1471 |
| 33599 | 1387 |
| 33600 | 1305 |
| 33601 | 1225 |
| 33602 | 1157 |
| 33603 | 1093 |
| 33604 | 1113 |
| 33605 | 1105 |
| 33606 | 1047 |
| 33607 | 1011 |
| 33608 | 980 |
| 33609 | 949 |
| 33610 | 918 |
| 33611 | 891 |
| 33612 | 863 |
| 33613 | 844 |
| 33614 | 829 |
| 33615 | 817 |
| 33616 | 825 |
| 33617 | 823 |
| 33618 | 817 |
| 33619 | 825 |
| 33620 | 856 |
| 33621 | 863 |
| 33622 | 882 |
| 33623 | 905 |
| 33624 | 945 |
| 33625 | 959 |
| 33626 | 1003 |
| 33627 | 1056 |
| 33628 | 1181 |
| 33629 | 1268 |
| 33630 | 1344 |
| 33631 | 1424 |
| 33632 | 1517 |
| 33633 | 1571 |
| 33634 | 1629 |
| 33635 | 1694 |
| 33636 | 1739 |
| 33637 | 1732 |
| 33638 | 1743 |
| 33639 | 1745 |
| 33640 | 1726 |
| 33641 | 1715 |
| 33642 | 1723 |
| 33643 | 1734 |
| 33644 | 1797 |
| 33645 | 1804 |
| 33646 | 1795 |
| 33647 | 1806 |
| 33648 | 1820 |
| 33649 | 1873 |
| 33650 | 1925 |
| 33651 | 1930 |
| 33652 | 1915 |
| 33653 | 1907 |
| 33654 | 1856 |
| 33655 | 1838 |
| 33656 | 1821 |
| 33657 | 1827 |
| 33658 | 1847 |
| 33659 | 1825 |
| 33660 | 1822 |
| 33661 | 1815 |
| 33662 | 1799 |
| 33663 | 1780 |
| 33664 | 1781 |
| 33665 | 1791 |
| 33666 | 1785 |
| 33667 | 1808 |
| 33668 | 1848 |
| 33669 | 1936 |
| 33670 | 2016 |
| 33671 | 2070 |
| 33672 | 2133 |
| 33673 | 2194 |
| 33674 | 2234 |
| 33675 | 2247 |
| 33676 | 2206 |
| 33677 | 2185 |
| 33678 | 2159 |
| 33679 | 2148 |
| 33680 | 2107 |
| 33681 | 2064 |
| 33682 | 2024 |
| 33683 | 1980 |
| 33684 | 1945 |
| 33685 | 1865 |
| 33686 | 1810 |
| 33687 | 1776 |
| 33688 | 1769 |
| 33689 | 1744 |
| 33690 | 1776 |
| 33691 | 1755 |
| 33692 | 1675 |
| 33693 | 1615 |
| 33694 | 1543 |
| 33695 | 1457 |
| 33696 | 1392 |
| 33697 | 1302 |
| 33698 | 1218 |
| 33699 | 1170 |
| 33700 | 1203 |
| 33701 | 1206 |
| 33702 | 1155 |
| 33703 | 1108 |
| 33704 | 1071 |
| 33705 | 1037 |
| 33706 | 1012 |
| 33707 | 989 |
| 33708 | 967 |
| 33709 | 964 |
| 33710 | 954 |
| 33711 | 926 |
| 33712 | 910 |
| 33713 | 897 |
| 33714 | 894 |
| 33715 | 889 |
| 33716 | 905 |
| 33717 | 916 |
| 33718 | 921 |
| 33719 | 911 |
| 33720 | 931 |
| 33721 | 943 |
| 33722 | 951 |
| 33723 | 951 |
| 33724 | 1032 |
| 33725 | 1072 |
| 33726 | 1114 |
| 33727 | 1156 |
| 33728 | 1210 |
| 33729 | 1267 |
| 33730 | 1335 |
| 33731 | 1397 |
| 33732 | 1435 |
| 33733 | 1493 |
| 33734 | 1543 |
| 33735 | 1563 |
| 33736 | 1596 |
| 33737 | 1605 |
| 33738 | 1612 |
| 33739 | 1644 |
| 33740 | 1653 |
| 33741 | 1681 |
| 33742 | 1730 |
| 33743 | 1750 |
| 33744 | 1756 |
| 33745 | 1768 |
| 33746 | 1841 |
| 33747 | 1939 |
| 33748 | 1941 |
| 33749 | 1922 |
| 33750 | 1898 |
| 33751 | 1878 |
| 33752 | 1870 |
| 33753 | 1879 |
| 33754 | 1913 |
| 33755 | 1897 |
| 33756 | 1883 |
| 33757 | 1865 |
| 33758 | 1839 |
| 33759 | 1819 |
| 33760 | 1808 |
| 33761 | 1825 |
| 33762 | 1854 |
| 33763 | 1888 |
| 33764 | 1921 |
| 33765 | 1972 |
| 33766 | 2058 |
| 33767 | 2107 |
| 33768 | 2162 |
| 33769 | 2200 |
| 33770 | 2239 |
| 33771 | 2246 |
| 33772 | 2231 |
| 33773 | 2190 |
| 33774 | 2175 |
| 33775 | 2136 |
| 33776 | 2091 |
| 33777 | 2049 |
| 33778 | 2006 |
| 33779 | 1975 |
| 33780 | 1933 |
| 33781 | 1880 |
| 33782 | 1836 |
| 33783 | 1768 |
| 33784 | 1760 |
| 33785 | 1741 |
| 33786 | 1789 |
| 33787 | 1794 |
| 33788 | 1727 |
| 33789 | 1687 |
| 33790 | 1626 |
| 33791 | 1569 |
| 33792 | 1498 |
| 33793 | 1428 |
| 33794 | 1347 |
| 33795 | 1274 |
| 33796 | 1332 |
| 33797 | 1339 |
| 33798 | 1287 |
| 33799 | 1244 |
| 33800 | 1202 |
| 33801 | 1165 |
| 33802 | 1120 |
| 33803 | 1080 |
| 33804 | 1048 |
| 33805 | 1028 |
| 33806 | 1009 |
| 33807 | 986 |
| 33808 | 969 |
| 33809 | 963 |
| 33810 | 947 |
| 33811 | 949 |
| 33812 | 953 |
| 33813 | 947 |
| 33814 | 951 |
| 33815 | 946 |
| 33816 | 955 |
| 33817 | 946 |
| 33818 | 943 |
| 33819 | 909 |
| 33820 | 951 |
| 33821 | 972 |
| 33822 | 1001 |
| 33823 | 1021 |
| 33824 | 1066 |
| 33825 | 1098 |
| 33826 | 1140 |
| 33827 | 1193 |
| 33828 | 1231 |
| 33829 | 1273 |
| 33830 | 1327 |
| 33831 | 1377 |
| 33832 | 1427 |
| 33833 | 1465 |
| 33834 | 1469 |
| 33835 | 1499 |
| 33836 | 1567 |
| 33837 | 1611 |
| 33838 | 1642 |
| 33839 | 1665 |
| 33840 | 1682 |
| 33841 | 1749 |
| 33842 | 1808 |
| 33843 | 1825 |
| 33844 | 1799 |
| 33845 | 1750 |
| 33846 | 1717 |
| 33847 | 1683 |
| 33848 | 1664 |
| 33849 | 1660 |
| 33850 | 1692 |
| 33851 | 1667 |
| 33852 | 1622 |
| 33853 | 1609 |
| 33854 | 1609 |
| 33855 | 1604 |
| 33856 | 1610 |
| 33857 | 1616 |
| 33858 | 1625 |
| 33859 | 1647 |
| 33860 | 1679 |
| 33861 | 1724 |
| 33862 | 1809 |
| 33863 | 1915 |
| 33864 | 2022 |
| 33865 | 2076 |
| 33866 | 2109 |
| 33867 | 2118 |
| 33868 | 2123 |
| 33869 | 2126 |
| 33870 | 2107 |
| 33871 | 2094 |
| 33872 | 2069 |
| 33873 | 2036 |
| 33874 | 2012 |
| 33875 | 1970 |
| 33876 | 1948 |
| 33877 | 1892 |
| 33878 | 1829 |
| 33879 | 1763 |
| 33880 | 1765 |
| 33881 | 1742 |
| 33882 | 1781 |
| 33883 | 1788 |
| 33884 | 1723 |
| 33885 | 1656 |
| 33886 | 1581 |
| 33887 | 1515 |
| 33888 | 1436 |
| 33889 | 1369 |
| 33890 | 1297 |
| 33891 | 1233 |
| 33892 | 1265 |
| 33893 | 1271 |
| 33894 | 1225 |
| 33895 | 1179 |
| 33896 | 1148 |
| 33897 | 1110 |
| 33898 | 1073 |
| 33899 | 1045 |
| 33900 | 1017 |
| 33901 | 997 |
| 33902 | 986 |
| 33903 | 971 |
| 33904 | 962 |
| 33905 | 944 |
| 33906 | 936 |
| 33907 | 941 |
| 33908 | 954 |
| 33909 | 952 |
| 33910 | 954 |
| 33911 | 973 |
| 33912 | 1000 |
| 33913 | 1011 |
| 33914 | 1035 |
| 33915 | 1052 |
| 33916 | 1154 |
| 33917 | 1226 |
| 33918 | 1289 |
| 33919 | 1348 |
| 33920 | 1432 |
| 33921 | 1492 |
| 33922 | 1555 |
| 33923 | 1621 |
| 33924 | 1671 |
| 33925 | 1706 |
| 33926 | 1727 |
| 33927 | 1746 |
| 33928 | 1747 |
| 33929 | 1765 |
| 33930 | 1771 |
| 33931 | 1761 |
| 33932 | 1800 |
| 33933 | 1814 |
| 33934 | 1822 |
| 33935 | 1853 |
| 33936 | 1877 |
| 33937 | 1908 |
| 33938 | 1942 |
| 33939 | 1965 |
| 33940 | 1960 |
| 33941 | 1927 |
| 33942 | 1904 |
| 33943 | 1898 |
| 33944 | 1910 |
| 33945 | 1924 |
| 33946 | 1949 |
| 33947 | 1937 |
| 33948 | 1936 |
| 33949 | 1931 |
| 33950 | 1927 |
| 33951 | 1911 |
| 33952 | 1900 |
| 33953 | 1899 |
| 33954 | 1895 |
| 33955 | 1895 |
| 33956 | 1943 |
| 33957 | 2009 |
| 33958 | 2093 |
| 33959 | 2167 |
| 33960 | 2242 |
| 33961 | 2294 |
| 33962 | 2330 |
| 33963 | 2348 |
| 33964 | 2335 |
| 33965 | 2317 |
| 33966 | 2308 |
| 33967 | 2292 |
| 33968 | 2256 |
| 33969 | 2208 |
| 33970 | 2176 |
| 33971 | 2142 |
| 33972 | 2094 |
| 33973 | 2018 |
| 33974 | 1955 |
| 33975 | 1905 |
| 33976 | 1888 |
| 33977 | 1851 |
| 33978 | 1869 |
| 33979 | 1857 |
| 33980 | 1776 |
| 33981 | 1699 |
| 33982 | 1617 |
| 33983 | 1545 |
| 33984 | 1462 |
| 33985 | 1391 |
| 33986 | 1314 |
| 33987 | 1245 |
| 33988 | 1295 |
| 33989 | 1301 |
| 33990 | 1255 |
| 33991 | 1213 |
| 33992 | 1179 |
| 33993 | 1141 |
| 33994 | 1102 |
| 33995 | 1072 |
| 33996 | 1042 |
| 33997 | 1029 |
| 33998 | 1019 |
| 33999 | 1010 |
| 34000 | 1007 |
| 34001 | 994 |
| 34002 | 994 |
| 34003 | 990 |
| 34004 | 1007 |
| 34005 | 1008 |
| 34006 | 1019 |
| 34007 | 1040 |
| 34008 | 1079 |
| 34009 | 1097 |
| 34010 | 1123 |
| 34011 | 1147 |
| 34012 | 1261 |
| 34013 | 1332 |
| 34014 | 1393 |
| 34015 | 1457 |
| 34016 | 1549 |
| 34017 | 1607 |
| 34018 | 1674 |
| 34019 | 1739 |
| 34020 | 1782 |
| 34021 | 1785 |
| 34022 | 1794 |
| 34023 | 1813 |
| 34024 | 1824 |
| 34025 | 1835 |
| 34026 | 1867 |
| 34027 | 1884 |
| 34028 | 1888 |
| 34029 | 1890 |
| 34030 | 1906 |
| 34031 | 1927 |
| 34032 | 1947 |
| 34033 | 1990 |
| 34034 | 2031 |
| 34035 | 2034 |
| 34036 | 2019 |
| 34037 | 1984 |
| 34038 | 1959 |
| 34039 | 1915 |
| 34040 | 1892 |
| 34041 | 1899 |
| 34042 | 1948 |
| 34043 | 1955 |
| 34044 | 1936 |
| 34045 | 1926 |
| 34046 | 1896 |
| 34047 | 1897 |
| 34048 | 1898 |
| 34049 | 1908 |
| 34050 | 1922 |
| 34051 | 1923 |
| 34052 | 1952 |
| 34053 | 2001 |
| 34054 | 2062 |
| 34055 | 2182 |
| 34056 | 2279 |
| 34057 | 2320 |
| 34058 | 2358 |
| 34059 | 2385 |
| 34060 | 2370 |
| 34061 | 2357 |
| 34062 | 2351 |
| 34063 | 2358 |
| 34064 | 2328 |
| 34065 | 2284 |
| 34066 | 2234 |
| 34067 | 2195 |
| 34068 | 2138 |
| 34069 | 2075 |
| 34070 | 2017 |
| 34071 | 1960 |
| 34072 | 1935 |
| 34073 | 1908 |
| 34074 | 1929 |
| 34075 | 1897 |
| 34076 | 1801 |
| 34077 | 1727 |
| 34078 | 1658 |
| 34079 | 1575 |
| 34080 | 1486 |
| 34081 | 1411 |
| 34082 | 1341 |
| 34083 | 1278 |
| 34084 | 1266 |
| 34085 | 1277 |
| 34086 | 1225 |
| 34087 | 1182 |
| 34088 | 1142 |
| 34089 | 1111 |
| 34090 | 1084 |
| 34091 | 1053 |
| 34092 | 1022 |
| 34093 | 1000 |
| 34094 | 989 |
| 34095 | 979 |
| 34096 | 977 |
| 34097 | 967 |
| 34098 | 972 |
| 34099 | 988 |
| 34100 | 1015 |
| 34101 | 1022 |
| 34102 | 1048 |
| 34103 | 1052 |
| 34104 | 1093 |
| 34105 | 1108 |
| 34106 | 1146 |
| 34107 | 1202 |
| 34108 | 1338 |
| 34109 | 1448 |
| 34110 | 1525 |
| 34111 | 1596 |
| 34112 | 1680 |
| 34113 | 1730 |
| 34114 | 1789 |
| 34115 | 1854 |
| 34116 | 1895 |
| 34117 | 1881 |
| 34118 | 1891 |
| 34119 | 1911 |
| 34120 | 1884 |
| 34121 | 1866 |
| 34122 | 1827 |
| 34123 | 1821 |
| 34124 | 1799 |
| 34125 | 1828 |
| 34126 | 1861 |
| 34127 | 1881 |
| 34128 | 1891 |
| 34129 | 1952 |
| 34130 | 1988 |
| 34131 | 2002 |
| 34132 | 1985 |
| 34133 | 1984 |
| 34134 | 1963 |
| 34135 | 1959 |
| 34136 | 1959 |
| 34137 | 1984 |
| 34138 | 2029 |
| 34139 | 2009 |
| 34140 | 2007 |
| 34141 | 1998 |
| 34142 | 1972 |
| 34143 | 1920 |
| 34144 | 1963 |
| 34145 | 1976 |
| 34146 | 2009 |
| 34147 | 2004 |
| 34148 | 2038 |
| 34149 | 2094 |
| 34150 | 2166 |
| 34151 | 2215 |
| 34152 | 2251 |
| 34153 | 2299 |
| 34154 | 2319 |
| 34155 | 2339 |
| 34156 | 2327 |
| 34157 | 2308 |
| 34158 | 2293 |
| 34159 | 2264 |
| 34160 | 2229 |
| 34161 | 2187 |
| 34162 | 2156 |
| 34163 | 2106 |
| 34164 | 2063 |
| 34165 | 1980 |
| 34166 | 1928 |
| 34167 | 1857 |
| 34168 | 1833 |
| 34169 | 1786 |
| 34170 | 1799 |
| 34171 | 1802 |
| 34172 | 1718 |
| 34173 | 1643 |
| 34174 | 1556 |
| 34175 | 1457 |
| 34176 | 1360 |
| 34177 | 1281 |
| 34178 | 1204 |
| 34179 | 1133 |
| 34180 | 1153 |
| 34181 | 1167 |
| 34182 | 1124 |
| 34183 | 1085 |
| 34184 | 1038 |
| 34185 | 996 |
| 34186 | 949 |
| 34187 | 925 |
| 34188 | 914 |
| 34189 | 902 |
| 34190 | 883 |
| 34191 | 871 |
| 34192 | 874 |
| 34193 | 873 |
| 34194 | 869 |
| 34195 | 864 |
| 34196 | 890 |
| 34197 | 899 |
| 34198 | 938 |
| 34199 | 982 |
| 34200 | 1022 |
| 34201 | 1040 |
| 34202 | 1077 |
| 34203 | 1129 |
| 34204 | 1266 |
| 34205 | 1351 |
| 34206 | 1439 |
| 34207 | 1498 |
| 34208 | 1573 |
| 34209 | 1635 |
| 34210 | 1686 |
| 34211 | 1750 |
| 34212 | 1792 |
| 34213 | 1787 |
| 34214 | 1818 |
| 34215 | 1841 |
| 34216 | 1822 |
| 34217 | 1798 |
| 34218 | 1781 |
| 34219 | 1786 |
| 34220 | 1801 |
| 34221 | 1803 |
| 34222 | 1804 |
| 34223 | 1828 |
| 34224 | 1846 |
| 34225 | 1835 |
| 34226 | 1892 |
| 34227 | 1909 |
| 34228 | 1901 |
| 34229 | 1875 |
| 34230 | 1823 |
| 34231 | 1808 |
| 34232 | 1811 |
| 34233 | 1836 |
| 34234 | 1878 |
| 34235 | 1850 |
| 34236 | 1865 |
| 34237 | 1864 |
| 34238 | 1860 |
| 34239 | 1848 |
| 34240 | 1842 |
| 34241 | 1836 |
| 34242 | 1827 |
| 34243 | 1849 |
| 34244 | 1878 |
| 34245 | 1939 |
| 34246 | 2057 |
| 34247 | 2111 |
| 34248 | 2158 |
| 34249 | 2187 |
| 34250 | 2233 |
| 34251 | 2245 |
| 34252 | 2215 |
| 34253 | 2194 |
| 34254 | 2178 |
| 34255 | 2161 |
| 34256 | 2129 |
| 34257 | 2088 |
| 34258 | 2022 |
| 34259 | 1992 |
| 34260 | 1959 |
| 34261 | 1878 |
| 34262 | 1812 |
| 34263 | 1754 |
| 34264 | 1727 |
| 34265 | 1682 |
| 34266 | 1708 |
| 34267 | 1672 |
| 34268 | 1614 |
| 34269 | 1528 |
| 34270 | 1443 |
| 34271 | 1359 |
| 34272 | 1266 |
| 34273 | 1190 |
| 34274 | 1129 |
| 34275 | 1066 |
| 34276 | 1082 |
| 34277 | 1078 |
| 34278 | 1015 |
| 34279 | 979 |
| 34280 | 943 |
| 34281 | 907 |
| 34282 | 875 |
| 34283 | 849 |
| 34284 | 823 |
| 34285 | 805 |
| 34286 | 793 |
| 34287 | 783 |
| 34288 | 786 |
| 34289 | 787 |
| 34290 | 784 |
| 34291 | 797 |
| 34292 | 827 |
| 34293 | 835 |
| 34294 | 857 |
| 34295 | 880 |
| 34296 | 921 |
| 34297 | 929 |
| 34298 | 974 |
| 34299 | 1026 |
| 34300 | 1153 |
| 34301 | 1231 |
| 34302 | 1307 |
| 34303 | 1391 |
| 34304 | 1486 |
| 34305 | 1533 |
| 34306 | 1593 |
| 34307 | 1663 |
| 34308 | 1709 |
| 34309 | 1688 |
| 34310 | 1694 |
| 34311 | 1700 |
| 34312 | 1698 |
| 34313 | 1681 |
| 34314 | 1677 |
| 34315 | 1683 |
| 34316 | 1752 |
| 34317 | 1769 |
| 34318 | 1748 |
| 34319 | 1756 |
| 34320 | 1773 |
| 34321 | 1844 |
| 34322 | 1909 |
| 34323 | 1924 |
| 34324 | 1912 |
| 34325 | 1904 |
| 34326 | 1836 |
| 34327 | 1819 |
| 34328 | 1787 |
| 34329 | 1797 |
| 34330 | 1820 |
| 34331 | 1817 |
| 34332 | 1807 |
| 34333 | 1789 |
| 34334 | 1779 |
| 34335 | 1753 |
| 34336 | 1740 |
| 34337 | 1757 |
| 34338 | 1758 |
| 34339 | 1786 |
| 34340 | 1823 |
| 34341 | 1903 |
| 34342 | 1987 |
| 34343 | 2046 |
| 34344 | 2122 |
| 34345 | 2190 |
| 34346 | 2239 |
| 34347 | 2252 |
| 34348 | 2215 |
| 34349 | 2185 |
| 34350 | 2154 |
| 34351 | 2154 |
| 34352 | 2114 |
| 34353 | 2077 |
| 34354 | 2034 |
| 34355 | 1991 |
| 34356 | 1953 |
| 34357 | 1877 |
| 34358 | 1815 |
| 34359 | 1792 |
| 34360 | 1795 |
| 34361 | 1755 |
| 34362 | 1787 |
| 34363 | 1775 |
| 34364 | 1693 |
| 34365 | 1630 |
| 34366 | 1553 |
| 34367 | 1470 |
| 34368 | 1408 |
| 34369 | 1319 |
| 34370 | 1224 |
| 34371 | 1176 |
| 34372 | 1202 |
| 34373 | 1207 |
| 34374 | 1150 |
| 34375 | 1104 |
| 34376 | 1064 |
| 34377 | 1029 |
| 34378 | 984 |
| 34379 | 944 |
| 34380 | 911 |
| 34381 | 884 |
| 34382 | 872 |
| 34383 | 868 |
| 34384 | 858 |
| 34385 | 852 |
| 34386 | 843 |
| 34387 | 842 |
| 34388 | 858 |
| 34389 | 847 |
| 34390 | 845 |
| 34391 | 860 |
| 34392 | 891 |
| 34393 | 891 |
| 34394 | 925 |
| 34395 | 906 |
| 34396 | 973 |
| 34397 | 1007 |
| 34398 | 1051 |
| 34399 | 1105 |
| 34400 | 1166 |
| 34401 | 1212 |
| 34402 | 1280 |
| 34403 | 1363 |
| 34404 | 1442 |
| 34405 | 1493 |
| 34406 | 1523 |
| 34407 | 1595 |
| 34408 | 1656 |
| 34409 | 1716 |
| 34410 | 1772 |
| 34411 | 1804 |
| 34412 | 1842 |
| 34413 | 1881 |
| 34414 | 1886 |
| 34415 | 1923 |
| 34416 | 1945 |
| 34417 | 1953 |
| 34418 | 1967 |
| 34419 | 1979 |
| 34420 | 2001 |
| 34421 | 1979 |
| 34422 | 1955 |
| 34423 | 1935 |
| 34424 | 1904 |
| 34425 | 1873 |
| 34426 | 1854 |
| 34427 | 1833 |
| 34428 | 1787 |
| 34429 | 1781 |
| 34430 | 1732 |
| 34431 | 1699 |
| 34432 | 1698 |
| 34433 | 1703 |
| 34434 | 1722 |
| 34435 | 1742 |
| 34436 | 1780 |
| 34437 | 1837 |
| 34438 | 1948 |
| 34439 | 2020 |
| 34440 | 2069 |
| 34441 | 2111 |
| 34442 | 2141 |
| 34443 | 2124 |
| 34444 | 2067 |
| 34445 | 1997 |
| 34446 | 1943 |
| 34447 | 1876 |
| 34448 | 1815 |
| 34449 | 1755 |
| 34450 | 1719 |
| 34451 | 1651 |
| 34452 | 1608 |
| 34453 | 1566 |
| 34454 | 1534 |
| 34455 | 1505 |
| 34456 | 1531 |
| 34457 | 1530 |
| 34458 | 1587 |
| 34459 | 1603 |
| 34460 | 1581 |
| 34461 | 1542 |
| 34462 | 1520 |
| 34463 | 1459 |
| 34464 | 1395 |
| 34465 | 1361 |
| 34466 | 1283 |
| 34467 | 1238 |
| 34468 | 1255 |
| 34469 | 1270 |
| 34470 | 1250 |
| 34471 | 1225 |
| 34472 | 1178 |
| 34473 | 1146 |
| 34474 | 1106 |
| 34475 | 1033 |
| 34476 | 1000 |
| 34477 | 968 |
| 34478 | 960 |
| 34479 | 951 |
| 34480 | 956 |
| 34481 | 885 |
| 34482 | 874 |
| 34483 | 888 |
| 34484 | 924 |
| 34485 | 923 |
| 34486 | 901 |
| 34487 | 871 |
| 34488 | 861 |
| 34489 | 851 |
| 34490 | 861 |
| 34491 | 826 |
| 34492 | 863 |
| 34493 | 882 |
| 34494 | 912 |
| 34495 | 941 |
| 34496 | 984 |
| 34497 | 1049 |
| 34498 | 1090 |
| 34499 | 1142 |
| 34500 | 1188 |
| 34501 | 1223 |
| 34502 | 1293 |
| 34503 | 1365 |
| 34504 | 1402 |
| 34505 | 1420 |
| 34506 | 1456 |
| 34507 | 1511 |
| 34508 | 1547 |
| 34509 | 1565 |
| 34510 | 1522 |
| 34511 | 1530 |
| 34512 | 1599 |
| 34513 | 1710 |
| 34514 | 1809 |
| 34515 | 1865 |
| 34516 | 1810 |
| 34517 | 1736 |
| 34518 | 1635 |
| 34519 | 1558 |
| 34520 | 1482 |
| 34521 | 1409 |
| 34522 | 1388 |
| 34523 | 1330 |
| 34524 | 1377 |
| 34525 | 1414 |
| 34526 | 1432 |
| 34527 | 1409 |
| 34528 | 1399 |
| 34529 | 1404 |
| 34530 | 1409 |
| 34531 | 1420 |
| 34532 | 1468 |
| 34533 | 1522 |
| 34534 | 1587 |
| 34535 | 1708 |
| 34536 | 1767 |
| 34537 | 1809 |
| 34538 | 1847 |
| 34539 | 1869 |
| 34540 | 1887 |
| 34541 | 1886 |
| 34542 | 1878 |
| 34543 | 1865 |
| 34544 | 1848 |
| 34545 | 1848 |
| 34546 | 1845 |
| 34547 | 1825 |
| 34548 | 1821 |
| 34549 | 1779 |
| 34550 | 1743 |
| 34551 | 1717 |
| 34552 | 1736 |
| 34553 | 1725 |
| 34554 | 1764 |
| 34555 | 1760 |
| 34556 | 1689 |
| 34557 | 1634 |
| 34558 | 1585 |
| 34559 | 1519 |
| 34560 | 1441 |
| 34561 | 1400 |
| 34562 | 1336 |
| 34563 | 1267 |
| 34564 | 1315 |
| 34565 | 1327 |
| 34566 | 1272 |
| 34567 | 1231 |
| 34568 | 1191 |
| 34569 | 1150 |
| 34570 | 1109 |
| 34571 | 1075 |
| 34572 | 1054 |
| 34573 | 1043 |
| 34574 | 1027 |
| 34575 | 1003 |
| 34576 | 1007 |
| 34577 | 1003 |
| 34578 | 993 |
| 34579 | 984 |
| 34580 | 992 |
| 34581 | 984 |
| 34582 | 983 |
| 34583 | 974 |
| 34584 | 981 |
| 34585 | 979 |
| 34586 | 978 |
| 34587 | 943 |
| 34588 | 974 |
| 34589 | 996 |
| 34590 | 1011 |
| 34591 | 1037 |
| 34592 | 1078 |
| 34593 | 1118 |
| 34594 | 1169 |
| 34595 | 1217 |
| 34596 | 1237 |
| 34597 | 1286 |
| 34598 | 1349 |
| 34599 | 1373 |
| 34600 | 1406 |
| 34601 | 1470 |
| 34602 | 1537 |
| 34603 | 1589 |
| 34604 | 1602 |
| 34605 | 1638 |
| 34606 | 1637 |
| 34607 | 1606 |
| 34608 | 1502 |
| 34609 | 1539 |
| 34610 | 1640 |
| 34611 | 1722 |
| 34612 | 1759 |
| 34613 | 1765 |
| 34614 | 1597 |
| 34615 | 1439 |
| 34616 | 1373 |
| 34617 | 1370 |
| 34618 | 1450 |
| 34619 | 1445 |
| 34620 | 1430 |
| 34621 | 1412 |
| 34622 | 1425 |
| 34623 | 1393 |
| 34624 | 1418 |
| 34625 | 1465 |
| 34626 | 1486 |
| 34627 | 1517 |
| 34628 | 1572 |
| 34629 | 1623 |
| 34630 | 1695 |
| 34631 | 1821 |
| 34632 | 1903 |
| 34633 | 1967 |
| 34634 | 2021 |
| 34635 | 2045 |
| 34636 | 2044 |
| 34637 | 2043 |
| 34638 | 2031 |
| 34639 | 2023 |
| 34640 | 1997 |
| 34641 | 1966 |
| 34642 | 1943 |
| 34643 | 1918 |
| 34644 | 1914 |
| 34645 | 1877 |
| 34646 | 1830 |
| 34647 | 1792 |
| 34648 | 1805 |
| 34649 | 1797 |
| 34650 | 1848 |
| 34651 | 1819 |
| 34652 | 1758 |
| 34653 | 1708 |
| 34654 | 1650 |
| 34655 | 1604 |
| 34656 | 1540 |
| 34657 | 1488 |
| 34658 | 1420 |
| 34659 | 1358 |
| 34660 | 1450 |
| 34661 | 1464 |
| 34662 | 1414 |
| 34663 | 1375 |
| 34664 | 1336 |
| 34665 | 1296 |
| 34666 | 1254 |
| 34667 | 1225 |
| 34668 | 1191 |
| 34669 | 1164 |
| 34670 | 1134 |
| 34671 | 1117 |
| 34672 | 1111 |
| 34673 | 1094 |
| 34674 | 1084 |
| 34675 | 1066 |
| 34676 | 1086 |
| 34677 | 1079 |
| 34678 | 1086 |
| 34679 | 1093 |
| 34680 | 1108 |
| 34681 | 1099 |
| 34682 | 1113 |
| 34683 | 1086 |
| 34684 | 1166 |
| 34685 | 1209 |
| 34686 | 1258 |
| 34687 | 1304 |
| 34688 | 1379 |
| 34689 | 1428 |
| 34690 | 1498 |
| 34691 | 1578 |
| 34692 | 1607 |
| 34693 | 1624 |
| 34694 | 1676 |
| 34695 | 1700 |
| 34696 | 1735 |
| 34697 | 1775 |
| 34698 | 1808 |
| 34699 | 1821 |
| 34700 | 1857 |
| 34701 | 1891 |
| 34702 | 1923 |
| 34703 | 1937 |
| 34704 | 1971 |
| 34705 | 2008 |
| 34706 | 2039 |
| 34707 | 2059 |
| 34708 | 2048 |
| 34709 | 2015 |
| 34710 | 2008 |
| 34711 | 1951 |
| 34712 | 1927 |
| 34713 | 1924 |
| 34714 | 1960 |
| 34715 | 1939 |
| 34716 | 1923 |
| 34717 | 1905 |
| 34718 | 1875 |
| 34719 | 1874 |
| 34720 | 1867 |
| 34721 | 1858 |
| 34722 | 1846 |
| 34723 | 1856 |
| 34724 | 1898 |
| 34725 | 1956 |
| 34726 | 2019 |
| 34727 | 2142 |
| 34728 | 2256 |
| 34729 | 2297 |
| 34730 | 2339 |
| 34731 | 2371 |
| 34732 | 2369 |
| 34733 | 2370 |
| 34734 | 2354 |
| 34735 | 2336 |
| 34736 | 2314 |
| 34737 | 2260 |
| 34738 | 2223 |
| 34739 | 2177 |
| 34740 | 2137 |
| 34741 | 2067 |
| 34742 | 2002 |
| 34743 | 1952 |
| 34744 | 1954 |
| 34745 | 1931 |
| 34746 | 1962 |
| 34747 | 1955 |
| 34748 | 1873 |
| 34749 | 1806 |
| 34750 | 1748 |
| 34751 | 1683 |
| 34752 | 1607 |
| 34753 | 1542 |
| 34754 | 1475 |
| 34755 | 1411 |
| 34756 | 1469 |
| 34757 | 1480 |
| 34758 | 1435 |
| 34759 | 1394 |
| 34760 | 1360 |
| 34761 | 1318 |
| 34762 | 1275 |
| 34763 | 1242 |
| 34764 | 1209 |
| 34765 | 1186 |
| 34766 | 1164 |
| 34767 | 1147 |
| 34768 | 1137 |
| 34769 | 1115 |
| 34770 | 1106 |
| 34771 | 1092 |
| 34772 | 1106 |
| 34773 | 1088 |
| 34774 | 1086 |
| 34775 | 1090 |
| 34776 | 1102 |
| 34777 | 1092 |
| 34778 | 1098 |
| 34779 | 1080 |
| 34780 | 1156 |
| 34781 | 1210 |
| 34782 | 1254 |
| 34783 | 1306 |
| 34784 | 1373 |
| 34785 | 1420 |
| 34786 | 1486 |
| 34787 | 1561 |
| 34788 | 1613 |
| 34789 | 1634 |
| 34790 | 1692 |
| 34791 | 1720 |
| 34792 | 1750 |
| 34793 | 1792 |
| 34794 | 1819 |
| 34795 | 1844 |
| 34796 | 1886 |
| 34797 | 1904 |
| 34798 | 1926 |
| 34799 | 1946 |
| 34800 | 1988 |
| 34801 | 2034 |
| 34802 | 2062 |
| 34803 | 2074 |
| 34804 | 2062 |
| 34805 | 2032 |
| 34806 | 2022 |
| 34807 | 1979 |
| 34808 | 1955 |
| 34809 | 1956 |
| 34810 | 1992 |
| 34811 | 1964 |
| 34812 | 1954 |
| 34813 | 1946 |
| 34814 | 1930 |
| 34815 | 1918 |
| 34816 | 1906 |
| 34817 | 1899 |
| 34818 | 1890 |
| 34819 | 1888 |
| 34820 | 1930 |
| 34821 | 1980 |
| 34822 | 2042 |
| 34823 | 2160 |
| 34824 | 2278 |
| 34825 | 2328 |
| 34826 | 2369 |
| 34827 | 2389 |
| 34828 | 2384 |
| 34829 | 2376 |
| 34830 | 2370 |
| 34831 | 2350 |
| 34832 | 2315 |
| 34833 | 2262 |
| 34834 | 2230 |
| 34835 | 2196 |
| 34836 | 2149 |
| 34837 | 2070 |
| 34838 | 2009 |
| 34839 | 1964 |
| 34840 | 1964 |
| 34841 | 1934 |
| 34842 | 1961 |
| 34843 | 1956 |
| 34844 | 1873 |
| 34845 | 1804 |
| 34846 | 1740 |
| 34847 | 1676 |
| 34848 | 1602 |
| 34849 | 1542 |
| 34850 | 1472 |
| 34851 | 1408 |
| 34852 | 1469 |
| 34853 | 1480 |
| 34854 | 1435 |
| 34855 | 1394 |
| 34856 | 1360 |
| 34857 | 1318 |
| 34858 | 1275 |
| 34859 | 1242 |
| 34860 | 1209 |
| 34861 | 1186 |
| 34862 | 1164 |
| 34863 | 1147 |
| 34864 | 1137 |
| 34865 | 1115 |
| 34866 | 1106 |
| 34867 | 1092 |
| 34868 | 1106 |
| 34869 | 1088 |
| 34870 | 1086 |
| 34871 | 1090 |
| 34872 | 1102 |
| 34873 | 1092 |
| 34874 | 1098 |
| 34875 | 1080 |
| 34876 | 1156 |
| 34877 | 1210 |
| 34878 | 1254 |
| 34879 | 1306 |
| 34880 | 1373 |
| 34881 | 1420 |
| 34882 | 1486 |
| 34883 | 1561 |
| 34884 | 1613 |
| 34885 | 1634 |
| 34886 | 1692 |
| 34887 | 1720 |
| 34888 | 1750 |
| 34889 | 1792 |
| 34890 | 1819 |
| 34891 | 1844 |
| 34892 | 1886 |
| 34893 | 1904 |
| 34894 | 1926 |
| 34895 | 1946 |
| 34896 | 1988 |
| 34897 | 2034 |
| 34898 | 2062 |
| 34899 | 2074 |
| 34900 | 2062 |
| 34901 | 2032 |
| 34902 | 2022 |
| 34903 | 1979 |
| 34904 | 1955 |
| 34905 | 1956 |
| 34906 | 1992 |
| 34907 | 1964 |
| 34908 | 1954 |
| 34909 | 1946 |
| 34910 | 1930 |
| 34911 | 1918 |
| 34912 | 1906 |
| 34913 | 1899 |
| 34914 | 1890 |
| 34915 | 1888 |
| 34916 | 1930 |
| 34917 | 1980 |
| 34918 | 2042 |
| 34919 | 2160 |
| 34920 | 2278 |
| 34921 | 2328 |
| 34922 | 2369 |
| 34923 | 2389 |
| 34924 | 2384 |
| 34925 | 2376 |
| 34926 | 2370 |
| 34927 | 2350 |
| 34928 | 2315 |
| 34929 | 2262 |
| 34930 | 2230 |
| 34931 | 2196 |
| 34932 | 2149 |
| 34933 | 2070 |
| 34934 | 2009 |
| 34935 | 1964 |
| 34936 | 1964 |
| 34937 | 1934 |
| 34938 | 1961 |
| 34939 | 1956 |
| 34940 | 1873 |
| 34941 | 1804 |
| 34942 | 1740 |
| 34943 | 1676 |
| 34944 | 1602 |
| 34945 | 1542 |
| 34946 | 1472 |
| 34947 | 1408 |
| 34948 | 1469 |
| 34949 | 1480 |
| 34950 | 1435 |
| 34951 | 1394 |
| 34952 | 1360 |
| 34953 | 1318 |
| 34954 | 1275 |
| 34955 | 1242 |
| 34956 | 1209 |
| 34957 | 1186 |
| 34958 | 1164 |
| 34959 | 1147 |
| 34960 | 1137 |
| 34961 | 1115 |
| 34962 | 1106 |
| 34963 | 1092 |
| 34964 | 1106 |
| 34965 | 1088 |
| 34966 | 1086 |
| 34967 | 1090 |
| 34968 | 1102 |
| 34969 | 1092 |
| 34970 | 1098 |
| 34971 | 1080 |
| 34972 | 1156 |
| 34973 | 1210 |
| 34974 | 1254 |
| 34975 | 1306 |
| 34976 | 1373 |
| 34977 | 1420 |
| 34978 | 1486 |
| 34979 | 1561 |
| 34980 | 1613 |
| 34981 | 1634 |
| 34982 | 1692 |
| 34983 | 1720 |
| 34984 | 1750 |
| 34985 | 1792 |
| 34986 | 1819 |
| 34987 | 1844 |
| 34988 | 1886 |
| 34989 | 1904 |
| 34990 | 1926 |
| 34991 | 1946 |
| 34992 | 1988 |
| 34993 | 2034 |
| 34994 | 2062 |
| 34995 | 2074 |
| 34996 | 2062 |
| 34997 | 2032 |
| 34998 | 2022 |
| 34999 | 1979 |
| 35000 | 1955 |
| 35001 | 1956 |
| 35002 | 1992 |
| 35003 | 1964 |
| 35004 | 1954 |
| 35005 | 1946 |
| 35006 | 1930 |
| 35007 | 1918 |
| 35008 | 1906 |
| 35009 | 1899 |
| 35010 | 1890 |
| 35011 | 1888 |
| 35012 | 1930 |
| 35013 | 1980 |
| 35014 | 2042 |
| 35015 | 2160 |
| 35016 | 2278 |
| 35017 | 2328 |
| 35018 | 2369 |
| 35019 | 2389 |
| 35020 | 2384 |
| 35021 | 2376 |
| 35022 | 2370 |
| 35023 | 2350 |
| 35024 | 2315 |
| 35025 | 2262 |
| 35026 | 2230 |
| 35027 | 2196 |
| 35028 | 2149 |
| 35029 | 2070 |
| 35030 | 2009 |
| 35031 | 1964 |
| 35032 | 1964 |
| 35033 | 1934 |
| 35034 | 1961 |
| 35035 | 1956 |
| 35036 | 1873 |
| 35037 | 1804 |
| 35038 | 1740 |
| 35039 | 1676 |
| 35040 | 1602 |
| 35041 | 1542 |
| 35042 | 1472 |
| 35043 | 1408 |
| 35044 | 1455 |
| 35045 | 1465 |
| 35046 | 1409 |
| 35047 | 1370 |
| 35048 | 1330 |
| 35049 | 1279 |
| 35050 | 1238 |
| 35051 | 1209 |
| 35052 | 1175 |
| 35053 | 1145 |
| 35054 | 1122 |
| 35055 | 1099 |
| 35056 | 1088 |
| 35057 | 1082 |
| 35058 | 1072 |
| 35059 | 1071 |
| 35060 | 1080 |
| 35061 | 1071 |
| 35062 | 1074 |
| 35063 | 1081 |
| 35064 | 1093 |
| 35065 | 1091 |
| 35066 | 1092 |
| 35067 | 1072 |
| 35068 | 1113 |
| 35069 | 1142 |
| 35070 | 1175 |
| 35071 | 1215 |
| 35072 | 1263 |
| 35073 | 1316 |
| 35074 | 1374 |
| 35075 | 1436 |
| 35076 | 1477 |
| 35077 | 1512 |
| 35078 | 1568 |
| 35079 | 1623 |
| 35080 | 1658 |
| 35081 | 1695 |
| 35082 | 1726 |
| 35083 | 1768 |
| 35084 | 1808 |
| 35085 | 1841 |
| 35086 | 1855 |
| 35087 | 1890 |
| 35088 | 1914 |
| 35089 | 1964 |
| 35090 | 1999 |
| 35091 | 2015 |
| 35092 | 2023 |
| 35093 | 2002 |
| 35094 | 1978 |
| 35095 | 1967 |
| 35096 | 1945 |
| 35097 | 1960 |
| 35098 | 2005 |
| 35099 | 1986 |
| 35100 | 1928 |
| 35101 | 1904 |
| 35102 | 1884 |
| 35103 | 1864 |
| 35104 | 1854 |
| 35105 | 1849 |
| 35106 | 1865 |
| 35107 | 1884 |
| 35108 | 1923 |
| 35109 | 1962 |
| 35110 | 2019 |
| 35111 | 2165 |
| 35112 | 2254 |
| 35113 | 2302 |
| 35114 | 2336 |
| 35115 | 2345 |
| 35116 | 2342 |
| 35117 | 2317 |
| 35118 | 2304 |
| 35119 | 2276 |
| 35120 | 2233 |
| 35121 | 2174 |
| 35122 | 2107 |
| 35123 | 2038 |
| 35124 | 1984 |
| 35125 | 1927 |
| 35126 | 1876 |
| 35127 | 1825 |
| 35128 | 1816 |
| 35129 | 1803 |
| 35130 | 1858 |
| 35131 | 1852 |
| 35132 | 1797 |
| 35133 | 1763 |
| 35134 | 1729 |
| 35135 | 1700 |
| 35136 | 1654 |
| 35137 | 1615 |
| 35138 | 1578 |
| 35139 | 1536 |